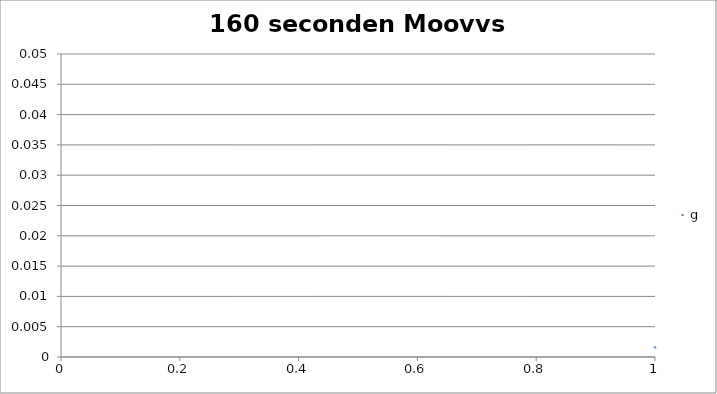
| Category | g |
|---|---|
| 0 | 0.002 |
| 1 | 0.005 |
| 2 | 0.004 |
| 3 | 0.005 |
| 4 | 0.006 |
| 5 | 0.005 |
| 6 | 0.003 |
| 7 | 0.004 |
| 8 | 0.007 |
| 9 | 0.009 |
| 10 | 0.005 |
| 11 | 0.002 |
| 12 | 0.005 |
| 13 | 0.003 |
| 14 | 0.009 |
| 15 | 0.007 |
| 16 | 0.002 |
| 17 | 0.007 |
| 18 | 0.002 |
| 19 | 0.003 |
| 20 | 0.005 |
| 21 | 0.005 |
| 22 | 0.006 |
| 23 | 0.006 |
| 24 | 0.007 |
| 25 | 0.009 |
| 26 | 0.004 |
| 27 | 0.006 |
| 28 | 0.006 |
| 29 | 0.004 |
| 30 | 0.005 |
| 31 | 0.002 |
| 32 | 0.007 |
| 33 | 0.004 |
| 34 | 0.003 |
| 35 | 0.013 |
| 36 | 0.016 |
| 37 | 0.005 |
| 38 | 0.004 |
| 39 | 0.004 |
| 40 | 0.007 |
| 41 | 0.007 |
| 42 | 0.005 |
| 43 | 0.004 |
| 44 | 0.002 |
| 45 | 0.003 |
| 46 | 0.008 |
| 47 | 0.003 |
| 48 | 0.002 |
| 49 | 0.003 |
| 50 | 0.002 |
| 51 | 0.004 |
| 52 | 0.002 |
| 53 | 0.002 |
| 54 | 0.004 |
| 55 | 0.004 |
| 56 | 0.001 |
| 57 | 0.002 |
| 58 | 0.003 |
| 59 | 0.003 |
| 60 | 0.001 |
| 61 | 0.005 |
| 62 | 0.007 |
| 63 | 0.004 |
| 64 | 0.002 |
| 65 | 0.006 |
| 66 | 0.007 |
| 67 | 0.004 |
| 68 | 0.003 |
| 69 | 0.002 |
| 70 | 0.007 |
| 71 | 0.006 |
| 72 | 0.004 |
| 73 | 0.006 |
| 74 | 0.002 |
| 75 | 0.004 |
| 76 | 0.001 |
| 77 | 0.007 |
| 78 | 0.009 |
| 79 | 0.004 |
| 80 | 0.006 |
| 81 | 0.004 |
| 82 | 0.006 |
| 83 | 0.007 |
| 84 | 0.001 |
| 85 | 0.003 |
| 86 | 0.005 |
| 87 | 0.009 |
| 88 | 0.001 |
| 89 | 0.002 |
| 90 | 0.003 |
| 91 | 0.005 |
| 92 | 0.002 |
| 93 | 0.002 |
| 94 | 0.001 |
| 95 | 0.006 |
| 96 | 0.002 |
| 97 | 0.002 |
| 98 | 0.003 |
| 99 | 0.008 |
| 100 | 0.002 |
| 101 | 0.001 |
| 102 | 0.003 |
| 103 | 0.005 |
| 104 | 0.001 |
| 105 | 0.002 |
| 106 | 0.004 |
| 107 | 0.003 |
| 108 | 0.001 |
| 109 | 0.003 |
| 110 | 0.002 |
| 111 | 0.004 |
| 112 | 0.003 |
| 113 | 0.004 |
| 114 | 0.004 |
| 115 | 0.002 |
| 116 | 0.004 |
| 117 | 0.007 |
| 118 | 0.012 |
| 119 | 0.003 |
| 120 | 0.001 |
| 121 | 0.004 |
| 122 | 0.003 |
| 123 | 0.002 |
| 124 | 0.003 |
| 125 | 0.002 |
| 126 | 0.004 |
| 127 | 0.004 |
| 128 | 0.003 |
| 129 | 0.003 |
| 130 | 0.004 |
| 131 | 0.007 |
| 132 | 0.002 |
| 133 | 0.003 |
| 134 | 0.002 |
| 135 | 0.001 |
| 136 | 0.008 |
| 137 | 0.003 |
| 138 | 0.005 |
| 139 | 0.007 |
| 140 | 0.001 |
| 141 | 0.001 |
| 142 | 0.001 |
| 143 | 0.005 |
| 144 | 0.002 |
| 145 | 0.007 |
| 146 | 0.006 |
| 147 | 0.005 |
| 148 | 0.002 |
| 149 | 0.003 |
| 150 | 0.007 |
| 151 | 0.003 |
| 152 | 0.005 |
| 153 | 0.003 |
| 154 | 0.002 |
| 155 | 0.002 |
| 156 | 0.004 |
| 157 | 0.003 |
| 158 | 0.006 |
| 159 | 0.004 |
| 160 | 0.005 |
| 161 | 0.002 |
| 162 | 0.003 |
| 163 | 0.004 |
| 164 | 0.002 |
| 165 | 0.006 |
| 166 | 0.005 |
| 167 | 0.005 |
| 168 | 0.005 |
| 169 | 0.002 |
| 170 | 0.008 |
| 171 | 0.002 |
| 172 | 0 |
| 173 | 0.009 |
| 174 | 0.009 |
| 175 | 0.006 |
| 176 | 0.002 |
| 177 | 0.002 |
| 178 | 0.004 |
| 179 | 0.005 |
| 180 | 0.003 |
| 181 | 0.003 |
| 182 | 0.004 |
| 183 | 0.007 |
| 184 | 0.003 |
| 185 | 0.003 |
| 186 | 0.002 |
| 187 | 0.004 |
| 188 | 0.003 |
| 189 | 0.003 |
| 190 | 0.005 |
| 191 | 0.002 |
| 192 | 0.003 |
| 193 | 0.003 |
| 194 | 0.01 |
| 195 | 0.001 |
| 196 | 0.008 |
| 197 | 0.002 |
| 198 | 0.004 |
| 199 | 0.005 |
| 200 | 0.005 |
| 201 | 0.006 |
| 202 | 0.006 |
| 203 | 0.007 |
| 204 | 0.002 |
| 205 | 0.002 |
| 206 | 0.004 |
| 207 | 0.008 |
| 208 | 0.013 |
| 209 | 0.002 |
| 210 | 0.004 |
| 211 | 0.002 |
| 212 | 0.002 |
| 213 | 0.003 |
| 214 | 0.004 |
| 215 | 0.006 |
| 216 | 0.004 |
| 217 | 0.002 |
| 218 | 0.003 |
| 219 | 0.009 |
| 220 | 0.002 |
| 221 | 0.002 |
| 222 | 0.009 |
| 223 | 0.005 |
| 224 | 0.005 |
| 225 | 0.007 |
| 226 | 0.005 |
| 227 | 0.004 |
| 228 | 0.001 |
| 229 | 0.001 |
| 230 | 0.008 |
| 231 | 0.003 |
| 232 | 0.001 |
| 233 | 0.004 |
| 234 | 0.006 |
| 235 | 0.007 |
| 236 | 0.003 |
| 237 | 0.002 |
| 238 | 0.005 |
| 239 | 0.004 |
| 240 | 0.002 |
| 241 | 0.002 |
| 242 | 0.005 |
| 243 | 0.004 |
| 244 | 0.001 |
| 245 | 0.002 |
| 246 | 0.004 |
| 247 | 0.006 |
| 248 | 0.003 |
| 249 | 0.002 |
| 250 | 0.003 |
| 251 | 0.002 |
| 252 | 0.005 |
| 253 | 0.006 |
| 254 | 0.005 |
| 255 | 0.004 |
| 256 | 0.004 |
| 257 | 0.003 |
| 258 | 0.006 |
| 259 | 0.003 |
| 260 | 0.006 |
| 261 | 0.002 |
| 262 | 0.002 |
| 263 | 0.006 |
| 264 | 0.011 |
| 265 | 0.003 |
| 266 | 0.002 |
| 267 | 0.004 |
| 268 | 0.005 |
| 269 | 0.001 |
| 270 | 0.003 |
| 271 | 0.002 |
| 272 | 0.003 |
| 273 | 0.002 |
| 274 | 0.005 |
| 275 | 0.001 |
| 276 | 0.003 |
| 277 | 0.004 |
| 278 | 0.005 |
| 279 | 0.002 |
| 280 | 0.005 |
| 281 | 0.002 |
| 282 | 0.004 |
| 283 | 0.003 |
| 284 | 0.009 |
| 285 | 0.003 |
| 286 | 0.003 |
| 287 | 0.002 |
| 288 | 0.001 |
| 289 | 0.002 |
| 290 | 0.005 |
| 291 | 0.002 |
| 292 | 0.003 |
| 293 | 0.002 |
| 294 | 0.001 |
| 295 | 0.006 |
| 296 | 0.001 |
| 297 | 0.009 |
| 298 | 0.001 |
| 299 | 0.005 |
| 300 | 0.003 |
| 301 | 0.002 |
| 302 | 0.004 |
| 303 | 0.003 |
| 304 | 0.002 |
| 305 | 0.004 |
| 306 | 0.006 |
| 307 | 0.007 |
| 308 | 0.002 |
| 309 | 0.002 |
| 310 | 0.011 |
| 311 | 0.01 |
| 312 | 0.002 |
| 313 | 0.005 |
| 314 | 0.004 |
| 315 | 0.008 |
| 316 | 0.008 |
| 317 | 0.002 |
| 318 | 0.002 |
| 319 | 0.006 |
| 320 | 0.004 |
| 321 | 0.003 |
| 322 | 0.003 |
| 323 | 0.004 |
| 324 | 0.004 |
| 325 | 0.002 |
| 326 | 0.003 |
| 327 | 0.004 |
| 328 | 0.004 |
| 329 | 0.006 |
| 330 | 0.004 |
| 331 | 0.002 |
| 332 | 0.005 |
| 333 | 0.007 |
| 334 | 0.008 |
| 335 | 0.008 |
| 336 | 0.008 |
| 337 | 0.007 |
| 338 | 0.004 |
| 339 | 0.008 |
| 340 | 0.005 |
| 341 | 0.005 |
| 342 | 0.008 |
| 343 | 0.008 |
| 344 | 0.01 |
| 345 | 0.007 |
| 346 | 0.007 |
| 347 | 0.007 |
| 348 | 0.004 |
| 349 | 0.006 |
| 350 | 0.004 |
| 351 | 0.005 |
| 352 | 0.007 |
| 353 | 0.002 |
| 354 | 0.004 |
| 355 | 0.003 |
| 356 | 0.003 |
| 357 | 0.007 |
| 358 | 0.004 |
| 359 | 0.004 |
| 360 | 0.002 |
| 361 | 0.003 |
| 362 | 0.006 |
| 363 | 0.007 |
| 364 | 0.003 |
| 365 | 0.004 |
| 366 | 0.003 |
| 367 | 0.007 |
| 368 | 0.002 |
| 369 | 0.007 |
| 370 | 0.004 |
| 371 | 0.003 |
| 372 | 0.004 |
| 373 | 0.006 |
| 374 | 0.006 |
| 375 | 0.004 |
| 376 | 0.005 |
| 377 | 0.004 |
| 378 | 0.005 |
| 379 | 0.003 |
| 380 | 0.004 |
| 381 | 0.002 |
| 382 | 0.007 |
| 383 | 0.006 |
| 384 | 0.004 |
| 385 | 0.004 |
| 386 | 0.005 |
| 387 | 0.006 |
| 388 | 0.003 |
| 389 | 0.002 |
| 390 | 0.002 |
| 391 | 0.004 |
| 392 | 0.003 |
| 393 | 0.006 |
| 394 | 0.01 |
| 395 | 0.007 |
| 396 | 0.003 |
| 397 | 0.004 |
| 398 | 0.004 |
| 399 | 0.007 |
| 400 | 0.001 |
| 401 | 0.004 |
| 402 | 0.004 |
| 403 | 0.003 |
| 404 | 0.001 |
| 405 | 0.003 |
| 406 | 0.006 |
| 407 | 0.002 |
| 408 | 0.003 |
| 409 | 0.001 |
| 410 | 0.003 |
| 411 | 0.004 |
| 412 | 0.001 |
| 413 | 0.001 |
| 414 | 0.005 |
| 415 | 0.005 |
| 416 | 0.003 |
| 417 | 0.002 |
| 418 | 0.004 |
| 419 | 0.002 |
| 420 | 0.001 |
| 421 | 0.001 |
| 422 | 0.002 |
| 423 | 0.004 |
| 424 | 0.003 |
| 425 | 0.002 |
| 426 | 0.005 |
| 427 | 0.006 |
| 428 | 0.002 |
| 429 | 0.004 |
| 430 | 0.008 |
| 431 | 0.003 |
| 432 | 0.002 |
| 433 | 0.002 |
| 434 | 0.007 |
| 435 | 0.003 |
| 436 | 0.003 |
| 437 | 0.002 |
| 438 | 0.005 |
| 439 | 0.006 |
| 440 | 0.004 |
| 441 | 0.001 |
| 442 | 0.004 |
| 443 | 0.012 |
| 444 | 0.005 |
| 445 | 0.007 |
| 446 | 0.011 |
| 447 | 0.009 |
| 448 | 0.003 |
| 449 | 0.003 |
| 450 | 0.01 |
| 451 | 0.004 |
| 452 | 0.004 |
| 453 | 0.003 |
| 454 | 0.003 |
| 455 | 0.005 |
| 456 | 0.002 |
| 457 | 0.003 |
| 458 | 0.005 |
| 459 | 0.001 |
| 460 | 0.003 |
| 461 | 0.003 |
| 462 | 0.009 |
| 463 | 0.011 |
| 464 | 0.003 |
| 465 | 0.003 |
| 466 | 0.005 |
| 467 | 0.002 |
| 468 | 0.003 |
| 469 | 0.006 |
| 470 | 0.003 |
| 471 | 0.009 |
| 472 | 0.002 |
| 473 | 0.002 |
| 474 | 0.004 |
| 475 | 0.001 |
| 476 | 0.003 |
| 477 | 0.003 |
| 478 | 0.006 |
| 479 | 0.009 |
| 480 | 0.003 |
| 481 | 0.004 |
| 482 | 0.003 |
| 483 | 0.004 |
| 484 | 0.001 |
| 485 | 0.003 |
| 486 | 0.007 |
| 487 | 0.009 |
| 488 | 0.003 |
| 489 | 0.004 |
| 490 | 0.004 |
| 491 | 0.003 |
| 492 | 0.001 |
| 493 | 0.003 |
| 494 | 0.005 |
| 495 | 0.003 |
| 496 | 0.002 |
| 497 | 0.002 |
| 498 | 0.005 |
| 499 | 0.01 |
| 500 | 0.002 |
| 501 | 0.004 |
| 502 | 0.003 |
| 503 | 0.004 |
| 504 | 0.003 |
| 505 | 0.001 |
| 506 | 0.008 |
| 507 | 0.014 |
| 508 | 0.002 |
| 509 | 0.005 |
| 510 | 0.003 |
| 511 | 0.006 |
| 512 | 0.004 |
| 513 | 0.003 |
| 514 | 0.008 |
| 515 | 0.008 |
| 516 | 0.001 |
| 517 | 0.002 |
| 518 | 0.003 |
| 519 | 0.008 |
| 520 | 0.003 |
| 521 | 0.002 |
| 522 | 0.006 |
| 523 | 0.008 |
| 524 | 0.002 |
| 525 | 0.001 |
| 526 | 0.004 |
| 527 | 0.004 |
| 528 | 0.005 |
| 529 | 0.002 |
| 530 | 0.009 |
| 531 | 0.006 |
| 532 | 0.004 |
| 533 | 0.005 |
| 534 | 0.004 |
| 535 | 0.005 |
| 536 | 0.007 |
| 537 | 0.008 |
| 538 | 0.007 |
| 539 | 0.005 |
| 540 | 0.003 |
| 541 | 0.005 |
| 542 | 0.002 |
| 543 | 0.005 |
| 544 | 0.006 |
| 545 | 0.001 |
| 546 | 0.003 |
| 547 | 0.004 |
| 548 | 0.007 |
| 549 | 0.002 |
| 550 | 0.001 |
| 551 | 0.004 |
| 552 | 0.004 |
| 553 | 0.002 |
| 554 | 0.003 |
| 555 | 0.003 |
| 556 | 0.005 |
| 557 | 0.006 |
| 558 | 0.003 |
| 559 | 0.004 |
| 560 | 0.006 |
| 561 | 0.002 |
| 562 | 0.008 |
| 563 | 0.001 |
| 564 | 0.006 |
| 565 | 0.009 |
| 566 | 0.003 |
| 567 | 0.004 |
| 568 | 0.003 |
| 569 | 0.005 |
| 570 | 0.007 |
| 571 | 0.006 |
| 572 | 0.003 |
| 573 | 0.003 |
| 574 | 0.004 |
| 575 | 0.004 |
| 576 | 0.008 |
| 577 | 0.004 |
| 578 | 0.004 |
| 579 | 0.002 |
| 580 | 0.002 |
| 581 | 0.002 |
| 582 | 0.002 |
| 583 | 0.01 |
| 584 | 0.002 |
| 585 | 0.002 |
| 586 | 0.003 |
| 587 | 0.008 |
| 588 | 0.004 |
| 589 | 0.012 |
| 590 | 0.008 |
| 591 | 0.004 |
| 592 | 0.002 |
| 593 | 0.002 |
| 594 | 0.004 |
| 595 | 0.002 |
| 596 | 0.005 |
| 597 | 0.002 |
| 598 | 0.003 |
| 599 | 0.004 |
| 600 | 0.003 |
| 601 | 0.006 |
| 602 | 0.002 |
| 603 | 0.003 |
| 604 | 0.002 |
| 605 | 0.004 |
| 606 | 0.005 |
| 607 | 0.003 |
| 608 | 0.007 |
| 609 | 0.004 |
| 610 | 0.003 |
| 611 | 0.006 |
| 612 | 0.004 |
| 613 | 0.003 |
| 614 | 0.002 |
| 615 | 0.006 |
| 616 | 0.006 |
| 617 | 0.005 |
| 618 | 0.007 |
| 619 | 0.007 |
| 620 | 0.007 |
| 621 | 0.004 |
| 622 | 0.004 |
| 623 | 0.001 |
| 624 | 0.001 |
| 625 | 0.006 |
| 626 | 0.003 |
| 627 | 0.011 |
| 628 | 0.004 |
| 629 | 0.004 |
| 630 | 0.005 |
| 631 | 0.003 |
| 632 | 0.008 |
| 633 | 0.006 |
| 634 | 0.007 |
| 635 | 0.003 |
| 636 | 0.008 |
| 637 | 0.004 |
| 638 | 0.004 |
| 639 | 0.013 |
| 640 | 0.007 |
| 641 | 0.006 |
| 642 | 0.006 |
| 643 | 0.008 |
| 644 | 0.007 |
| 645 | 0.006 |
| 646 | 0.006 |
| 647 | 0.002 |
| 648 | 0.001 |
| 649 | 0.002 |
| 650 | 0.004 |
| 651 | 0.003 |
| 652 | 0.003 |
| 653 | 0.003 |
| 654 | 0.003 |
| 655 | 0.003 |
| 656 | 0.005 |
| 657 | 0.003 |
| 658 | 0.001 |
| 659 | 0.007 |
| 660 | 0.001 |
| 661 | 0.004 |
| 662 | 0.006 |
| 663 | 0.006 |
| 664 | 0.003 |
| 665 | 0.002 |
| 666 | 0.003 |
| 667 | 0.007 |
| 668 | 0.003 |
| 669 | 0.004 |
| 670 | 0.002 |
| 671 | 0.001 |
| 672 | 0.003 |
| 673 | 0.002 |
| 674 | 0.003 |
| 675 | 0.004 |
| 676 | 0.004 |
| 677 | 0.002 |
| 678 | 0.002 |
| 679 | 0.004 |
| 680 | 0.009 |
| 681 | 0.002 |
| 682 | 0.003 |
| 683 | 0.002 |
| 684 | 0.002 |
| 685 | 0.003 |
| 686 | 0.004 |
| 687 | 0.006 |
| 688 | 0.002 |
| 689 | 0.004 |
| 690 | 0.005 |
| 691 | 0.005 |
| 692 | 0.003 |
| 693 | 0.003 |
| 694 | 0.004 |
| 695 | 0.004 |
| 696 | 0.002 |
| 697 | 0.002 |
| 698 | 0.004 |
| 699 | 0.003 |
| 700 | 0.002 |
| 701 | 0.001 |
| 702 | 0.003 |
| 703 | 0.005 |
| 704 | 0.003 |
| 705 | 0.005 |
| 706 | 0.01 |
| 707 | 0.004 |
| 708 | 0.003 |
| 709 | 0.006 |
| 710 | 0.005 |
| 711 | 0.008 |
| 712 | 0.003 |
| 713 | 0.002 |
| 714 | 0.004 |
| 715 | 0.005 |
| 716 | 0.003 |
| 717 | 0.002 |
| 718 | 0.004 |
| 719 | 0.002 |
| 720 | 0.005 |
| 721 | 0.004 |
| 722 | 0.006 |
| 723 | 0.003 |
| 724 | 0.002 |
| 725 | 0.003 |
| 726 | 0.004 |
| 727 | 0.006 |
| 728 | 0.002 |
| 729 | 0.004 |
| 730 | 0.005 |
| 731 | 0.005 |
| 732 | 0.001 |
| 733 | 0.006 |
| 734 | 0.005 |
| 735 | 0.006 |
| 736 | 0.001 |
| 737 | 0.006 |
| 738 | 0.004 |
| 739 | 0.006 |
| 740 | 0.005 |
| 741 | 0.002 |
| 742 | 0.003 |
| 743 | 0.007 |
| 744 | 0.002 |
| 745 | 0.006 |
| 746 | 0.003 |
| 747 | 0.005 |
| 748 | 0.001 |
| 749 | 0.004 |
| 750 | 0.014 |
| 751 | 0.006 |
| 752 | 0.001 |
| 753 | 0.002 |
| 754 | 0.003 |
| 755 | 0.004 |
| 756 | 0.002 |
| 757 | 0.001 |
| 758 | 0.003 |
| 759 | 0.007 |
| 760 | 0.002 |
| 761 | 0.002 |
| 762 | 0.003 |
| 763 | 0.012 |
| 764 | 0.003 |
| 765 | 0.004 |
| 766 | 0.013 |
| 767 | 0.015 |
| 768 | 0.008 |
| 769 | 0.001 |
| 770 | 0.004 |
| 771 | 0.002 |
| 772 | 0.002 |
| 773 | 0.002 |
| 774 | 0.003 |
| 775 | 0.007 |
| 776 | 0.009 |
| 777 | 0.003 |
| 778 | 0.004 |
| 779 | 0.002 |
| 780 | 0.004 |
| 781 | 0.003 |
| 782 | 0.004 |
| 783 | 0.005 |
| 784 | 0.003 |
| 785 | 0.001 |
| 786 | 0.004 |
| 787 | 0.004 |
| 788 | 0.005 |
| 789 | 0.004 |
| 790 | 0.002 |
| 791 | 0.002 |
| 792 | 0.003 |
| 793 | 0.002 |
| 794 | 0.004 |
| 795 | 0.007 |
| 796 | 0.011 |
| 797 | 0.002 |
| 798 | 0.003 |
| 799 | 0.004 |
| 800 | 0.006 |
| 801 | 0.002 |
| 802 | 0.007 |
| 803 | 0.009 |
| 804 | 0.006 |
| 805 | 0.004 |
| 806 | 0.004 |
| 807 | 0.004 |
| 808 | 0.004 |
| 809 | 0.006 |
| 810 | 0.004 |
| 811 | 0.004 |
| 812 | 0.001 |
| 813 | 0.003 |
| 814 | 0.001 |
| 815 | 0.005 |
| 816 | 0.016 |
| 817 | 0.001 |
| 818 | 0.002 |
| 819 | 0.009 |
| 820 | 0.004 |
| 821 | 0.005 |
| 822 | 0.006 |
| 823 | 0.006 |
| 824 | 0.012 |
| 825 | 0.007 |
| 826 | 0.006 |
| 827 | 0.01 |
| 828 | 0.003 |
| 829 | 0.003 |
| 830 | 0.008 |
| 831 | 0.008 |
| 832 | 0.002 |
| 833 | 0.003 |
| 834 | 0.004 |
| 835 | 0.002 |
| 836 | 0.001 |
| 837 | 0.001 |
| 838 | 0.005 |
| 839 | 0.005 |
| 840 | 0.006 |
| 841 | 0.005 |
| 842 | 0.006 |
| 843 | 0.004 |
| 844 | 0.001 |
| 845 | 0.003 |
| 846 | 0.002 |
| 847 | 0.009 |
| 848 | 0.002 |
| 849 | 0.003 |
| 850 | 0.01 |
| 851 | 0.003 |
| 852 | 0.003 |
| 853 | 0.005 |
| 854 | 0.005 |
| 855 | 0.005 |
| 856 | 0.002 |
| 857 | 0.004 |
| 858 | 0.005 |
| 859 | 0.006 |
| 860 | 0.002 |
| 861 | 0.003 |
| 862 | 0.009 |
| 863 | 0.004 |
| 864 | 0.002 |
| 865 | 0.002 |
| 866 | 0.003 |
| 867 | 0.008 |
| 868 | 0.003 |
| 869 | 0.001 |
| 870 | 0.002 |
| 871 | 0.003 |
| 872 | 0.007 |
| 873 | 0.004 |
| 874 | 0.002 |
| 875 | 0.003 |
| 876 | 0.006 |
| 877 | 0.004 |
| 878 | 0.004 |
| 879 | 0.006 |
| 880 | 0.007 |
| 881 | 0.002 |
| 882 | 0.004 |
| 883 | 0.003 |
| 884 | 0.007 |
| 885 | 0.002 |
| 886 | 0.002 |
| 887 | 0.001 |
| 888 | 0.005 |
| 889 | 0.009 |
| 890 | 0.006 |
| 891 | 0.007 |
| 892 | 0.005 |
| 893 | 0.004 |
| 894 | 0.004 |
| 895 | 0.005 |
| 896 | 0.003 |
| 897 | 0.001 |
| 898 | 0.003 |
| 899 | 0.005 |
| 900 | 0.001 |
| 901 | 0.003 |
| 902 | 0.003 |
| 903 | 0.002 |
| 904 | 0.007 |
| 905 | 0.002 |
| 906 | 0.002 |
| 907 | 0.002 |
| 908 | 0.003 |
| 909 | 0.001 |
| 910 | 0.006 |
| 911 | 0.005 |
| 912 | 0.002 |
| 913 | 0.002 |
| 914 | 0.003 |
| 915 | 0.002 |
| 916 | 0.002 |
| 917 | 0.01 |
| 918 | 0.007 |
| 919 | 0.004 |
| 920 | 0.008 |
| 921 | 0.004 |
| 922 | 0.01 |
| 923 | 0.007 |
| 924 | 0.007 |
| 925 | 0.003 |
| 926 | 0.003 |
| 927 | 0.001 |
| 928 | 0.003 |
| 929 | 0.003 |
| 930 | 0.001 |
| 931 | 0.005 |
| 932 | 0.002 |
| 933 | 0.004 |
| 934 | 0.004 |
| 935 | 0.005 |
| 936 | 0.006 |
| 937 | 0.004 |
| 938 | 0.01 |
| 939 | 0.005 |
| 940 | 0.003 |
| 941 | 0.003 |
| 942 | 0.005 |
| 943 | 0.004 |
| 944 | 0.01 |
| 945 | 0.006 |
| 946 | 0.001 |
| 947 | 0.003 |
| 948 | 0.005 |
| 949 | 0.005 |
| 950 | 0.002 |
| 951 | 0.007 |
| 952 | 0.004 |
| 953 | 0.008 |
| 954 | 0.007 |
| 955 | 0.004 |
| 956 | 0.013 |
| 957 | 0.006 |
| 958 | 0.004 |
| 959 | 0.002 |
| 960 | 0.003 |
| 961 | 0.004 |
| 962 | 0.007 |
| 963 | 0 |
| 964 | 0.005 |
| 965 | 0.003 |
| 966 | 0.002 |
| 967 | 0.005 |
| 968 | 0.011 |
| 969 | 0.007 |
| 970 | 0.005 |
| 971 | 0.003 |
| 972 | 0.008 |
| 973 | 0.002 |
| 974 | 0.006 |
| 975 | 0.01 |
| 976 | 0.002 |
| 977 | 0.002 |
| 978 | 0.003 |
| 979 | 0.004 |
| 980 | 0.004 |
| 981 | 0.001 |
| 982 | 0.003 |
| 983 | 0.002 |
| 984 | 0.002 |
| 985 | 0.002 |
| 986 | 0.002 |
| 987 | 0.006 |
| 988 | 0.005 |
| 989 | 0.004 |
| 990 | 0.003 |
| 991 | 0.006 |
| 992 | 0.004 |
| 993 | 0.006 |
| 994 | 0.008 |
| 995 | 0.005 |
| 996 | 0.003 |
| 997 | 0.003 |
| 998 | 0.005 |
| 999 | 0.005 |
| 1000 | 0.003 |
| 1001 | 0.004 |
| 1002 | 0.005 |
| 1003 | 0.005 |
| 1004 | 0.002 |
| 1005 | 0.001 |
| 1006 | 0.009 |
| 1007 | 0.006 |
| 1008 | 0.003 |
| 1009 | 0.005 |
| 1010 | 0.005 |
| 1011 | 0.005 |
| 1012 | 0.003 |
| 1013 | 0.008 |
| 1014 | 0.002 |
| 1015 | 0.004 |
| 1016 | 0.006 |
| 1017 | 0.002 |
| 1018 | 0.001 |
| 1019 | 0.007 |
| 1020 | 0.004 |
| 1021 | 0.003 |
| 1022 | 0.003 |
| 1023 | 0.008 |
| 1024 | 0.004 |
| 1025 | 0.002 |
| 1026 | 0.008 |
| 1027 | 0.006 |
| 1028 | 0.003 |
| 1029 | 0.002 |
| 1030 | 0.002 |
| 1031 | 0.003 |
| 1032 | 0.002 |
| 1033 | 0.002 |
| 1034 | 0.003 |
| 1035 | 0.009 |
| 1036 | 0.004 |
| 1037 | 0.008 |
| 1038 | 0.01 |
| 1039 | 0.007 |
| 1040 | 0.002 |
| 1041 | 0.003 |
| 1042 | 0.002 |
| 1043 | 0.005 |
| 1044 | 0.003 |
| 1045 | 0.002 |
| 1046 | 0.005 |
| 1047 | 0.003 |
| 1048 | 0.001 |
| 1049 | 0.002 |
| 1050 | 0.007 |
| 1051 | 0.006 |
| 1052 | 0.003 |
| 1053 | 0.003 |
| 1054 | 0.003 |
| 1055 | 0.006 |
| 1056 | 0.003 |
| 1057 | 0.002 |
| 1058 | 0.003 |
| 1059 | 0.01 |
| 1060 | 0.003 |
| 1061 | 0.004 |
| 1062 | 0.004 |
| 1063 | 0.004 |
| 1064 | 0.005 |
| 1065 | 0.002 |
| 1066 | 0.004 |
| 1067 | 0.006 |
| 1068 | 0.001 |
| 1069 | 0.001 |
| 1070 | 0.007 |
| 1071 | 0.005 |
| 1072 | 0.002 |
| 1073 | 0.002 |
| 1074 | 0.003 |
| 1075 | 0.003 |
| 1076 | 0.001 |
| 1077 | 0.003 |
| 1078 | 0.003 |
| 1079 | 0.004 |
| 1080 | 0.003 |
| 1081 | 0.003 |
| 1082 | 0.007 |
| 1083 | 0.009 |
| 1084 | 0.004 |
| 1085 | 0.006 |
| 1086 | 0.006 |
| 1087 | 0.006 |
| 1088 | 0.002 |
| 1089 | 0.007 |
| 1090 | 0.003 |
| 1091 | 0.007 |
| 1092 | 0.003 |
| 1093 | 0.003 |
| 1094 | 0.004 |
| 1095 | 0.003 |
| 1096 | 0.003 |
| 1097 | 0.002 |
| 1098 | 0.005 |
| 1099 | 0.003 |
| 1100 | 0.003 |
| 1101 | 0.002 |
| 1102 | 0.005 |
| 1103 | 0.006 |
| 1104 | 0.003 |
| 1105 | 0.003 |
| 1106 | 0.007 |
| 1107 | 0.004 |
| 1108 | 0.004 |
| 1109 | 0.002 |
| 1110 | 0.003 |
| 1111 | 0.009 |
| 1112 | 0.003 |
| 1113 | 0.004 |
| 1114 | 0.003 |
| 1115 | 0.005 |
| 1116 | 0.004 |
| 1117 | 0.007 |
| 1118 | 0.006 |
| 1119 | 0.007 |
| 1120 | 0.001 |
| 1121 | 0.003 |
| 1122 | 0.006 |
| 1123 | 0.005 |
| 1124 | 0.003 |
| 1125 | 0.004 |
| 1126 | 0.006 |
| 1127 | 0.003 |
| 1128 | 0.001 |
| 1129 | 0.002 |
| 1130 | 0.007 |
| 1131 | 0.002 |
| 1132 | 0.004 |
| 1133 | 0.004 |
| 1134 | 0.005 |
| 1135 | 0.002 |
| 1136 | 0.006 |
| 1137 | 0.009 |
| 1138 | 0.005 |
| 1139 | 0.002 |
| 1140 | 0.002 |
| 1141 | 0.004 |
| 1142 | 0.004 |
| 1143 | 0 |
| 1144 | 0.002 |
| 1145 | 0.003 |
| 1146 | 0.003 |
| 1147 | 0.003 |
| 1148 | 0.002 |
| 1149 | 0.002 |
| 1150 | 0.008 |
| 1151 | 0.004 |
| 1152 | 0.001 |
| 1153 | 0.002 |
| 1154 | 0.012 |
| 1155 | 0.004 |
| 1156 | 0.001 |
| 1157 | 0.004 |
| 1158 | 0.009 |
| 1159 | 0.012 |
| 1160 | 0.009 |
| 1161 | 0.002 |
| 1162 | 0.003 |
| 1163 | 0.001 |
| 1164 | 0.003 |
| 1165 | 0.003 |
| 1166 | 0.003 |
| 1167 | 0.003 |
| 1168 | 0.006 |
| 1169 | 0.002 |
| 1170 | 0.007 |
| 1171 | 0.002 |
| 1172 | 0.007 |
| 1173 | 0.001 |
| 1174 | 0.007 |
| 1175 | 0.009 |
| 1176 | 0.008 |
| 1177 | 0.005 |
| 1178 | 0.007 |
| 1179 | 0.001 |
| 1180 | 0.004 |
| 1181 | 0.005 |
| 1182 | 0.002 |
| 1183 | 0.002 |
| 1184 | 0.006 |
| 1185 | 0.003 |
| 1186 | 0.002 |
| 1187 | 0.004 |
| 1188 | 0.002 |
| 1189 | 0.002 |
| 1190 | 0.003 |
| 1191 | 0.009 |
| 1192 | 0.004 |
| 1193 | 0.007 |
| 1194 | 0.01 |
| 1195 | 0.005 |
| 1196 | 0.007 |
| 1197 | 0.007 |
| 1198 | 0.003 |
| 1199 | 0.002 |
| 1200 | 0.004 |
| 1201 | 0.011 |
| 1202 | 0.008 |
| 1203 | 0.004 |
| 1204 | 0.008 |
| 1205 | 0.004 |
| 1206 | 0.005 |
| 1207 | 0.007 |
| 1208 | 0.005 |
| 1209 | 0.007 |
| 1210 | 0.003 |
| 1211 | 0.006 |
| 1212 | 0.008 |
| 1213 | 0.003 |
| 1214 | 0.007 |
| 1215 | 0.005 |
| 1216 | 0.004 |
| 1217 | 0.002 |
| 1218 | 0.001 |
| 1219 | 0.003 |
| 1220 | 0.002 |
| 1221 | 0.006 |
| 1222 | 0.004 |
| 1223 | 0.001 |
| 1224 | 0.006 |
| 1225 | 0.001 |
| 1226 | 0.005 |
| 1227 | 0.002 |
| 1228 | 0.005 |
| 1229 | 0.005 |
| 1230 | 0.004 |
| 1231 | 0.003 |
| 1232 | 0.007 |
| 1233 | 0.01 |
| 1234 | 0.006 |
| 1235 | 0.003 |
| 1236 | 0.003 |
| 1237 | 0.003 |
| 1238 | 0.004 |
| 1239 | 0.004 |
| 1240 | 0.004 |
| 1241 | 0.005 |
| 1242 | 0.005 |
| 1243 | 0.006 |
| 1244 | 0.002 |
| 1245 | 0.001 |
| 1246 | 0.004 |
| 1247 | 0.009 |
| 1248 | 0.003 |
| 1249 | 0.007 |
| 1250 | 0.004 |
| 1251 | 0.002 |
| 1252 | 0.005 |
| 1253 | 0.009 |
| 1254 | 0.004 |
| 1255 | 0.001 |
| 1256 | 0.001 |
| 1257 | 0.004 |
| 1258 | 0.01 |
| 1259 | 0.005 |
| 1260 | 0.002 |
| 1261 | 0.005 |
| 1262 | 0.009 |
| 1263 | 0.008 |
| 1264 | 0.004 |
| 1265 | 0.003 |
| 1266 | 0.006 |
| 1267 | 0.003 |
| 1268 | 0.005 |
| 1269 | 0.004 |
| 1270 | 0.003 |
| 1271 | 0.004 |
| 1272 | 0.002 |
| 1273 | 0.005 |
| 1274 | 0.004 |
| 1275 | 0.005 |
| 1276 | 0.001 |
| 1277 | 0.007 |
| 1278 | 0.002 |
| 1279 | 0.002 |
| 1280 | 0.007 |
| 1281 | 0.008 |
| 1282 | 0.006 |
| 1283 | 0.007 |
| 1284 | 0.003 |
| 1285 | 0.001 |
| 1286 | 0.004 |
| 1287 | 0.008 |
| 1288 | 0.002 |
| 1289 | 0.004 |
| 1290 | 0.002 |
| 1291 | 0.007 |
| 1292 | 0.001 |
| 1293 | 0.002 |
| 1294 | 0.002 |
| 1295 | 0.004 |
| 1296 | 0.002 |
| 1297 | 0.002 |
| 1298 | 0.002 |
| 1299 | 0.002 |
| 1300 | 0.003 |
| 1301 | 0.002 |
| 1302 | 0.007 |
| 1303 | 0.004 |
| 1304 | 0.007 |
| 1305 | 0.006 |
| 1306 | 0.01 |
| 1307 | 0.004 |
| 1308 | 0.001 |
| 1309 | 0.002 |
| 1310 | 0.004 |
| 1311 | 0.005 |
| 1312 | 0.002 |
| 1313 | 0.002 |
| 1314 | 0.007 |
| 1315 | 0.003 |
| 1316 | 0.001 |
| 1317 | 0.001 |
| 1318 | 0.005 |
| 1319 | 0.004 |
| 1320 | 0.002 |
| 1321 | 0.004 |
| 1322 | 0.003 |
| 1323 | 0.003 |
| 1324 | 0.001 |
| 1325 | 0.003 |
| 1326 | 0.005 |
| 1327 | 0.003 |
| 1328 | 0.001 |
| 1329 | 0.001 |
| 1330 | 0.006 |
| 1331 | 0.005 |
| 1332 | 0.006 |
| 1333 | 0.003 |
| 1334 | 0.005 |
| 1335 | 0.002 |
| 1336 | 0.002 |
| 1337 | 0.004 |
| 1338 | 0.005 |
| 1339 | 0.002 |
| 1340 | 0.011 |
| 1341 | 0.003 |
| 1342 | 0.003 |
| 1343 | 0.007 |
| 1344 | 0.005 |
| 1345 | 0.003 |
| 1346 | 0.002 |
| 1347 | 0.006 |
| 1348 | 0.002 |
| 1349 | 0.005 |
| 1350 | 0.002 |
| 1351 | 0.002 |
| 1352 | 0.003 |
| 1353 | 0.003 |
| 1354 | 0.004 |
| 1355 | 0.005 |
| 1356 | 0.002 |
| 1357 | 0.006 |
| 1358 | 0.005 |
| 1359 | 0.007 |
| 1360 | 0.002 |
| 1361 | 0.006 |
| 1362 | 0.01 |
| 1363 | 0.005 |
| 1364 | 0.002 |
| 1365 | 0.002 |
| 1366 | 0.008 |
| 1367 | 0.009 |
| 1368 | 0.003 |
| 1369 | 0.005 |
| 1370 | 0.009 |
| 1371 | 0.002 |
| 1372 | 0.003 |
| 1373 | 0.003 |
| 1374 | 0.008 |
| 1375 | 0.005 |
| 1376 | 0.003 |
| 1377 | 0.003 |
| 1378 | 0.004 |
| 1379 | 0.007 |
| 1380 | 0.003 |
| 1381 | 0.002 |
| 1382 | 0.006 |
| 1383 | 0.001 |
| 1384 | 0.002 |
| 1385 | 0.003 |
| 1386 | 0.005 |
| 1387 | 0.006 |
| 1388 | 0.002 |
| 1389 | 0.006 |
| 1390 | 0.013 |
| 1391 | 0.005 |
| 1392 | 0.001 |
| 1393 | 0.002 |
| 1394 | 0.001 |
| 1395 | 0.003 |
| 1396 | 0.002 |
| 1397 | 0.008 |
| 1398 | 0.007 |
| 1399 | 0.006 |
| 1400 | 0.002 |
| 1401 | 0.003 |
| 1402 | 0.004 |
| 1403 | 0.009 |
| 1404 | 0.004 |
| 1405 | 0.006 |
| 1406 | 0.009 |
| 1407 | 0.005 |
| 1408 | 0.002 |
| 1409 | 0.003 |
| 1410 | 0.004 |
| 1411 | 0.003 |
| 1412 | 0.002 |
| 1413 | 0.007 |
| 1414 | 0.005 |
| 1415 | 0.006 |
| 1416 | 0.004 |
| 1417 | 0.006 |
| 1418 | 0.004 |
| 1419 | 0.002 |
| 1420 | 0.004 |
| 1421 | 0.004 |
| 1422 | 0.004 |
| 1423 | 0.004 |
| 1424 | 0.008 |
| 1425 | 0.003 |
| 1426 | 0.004 |
| 1427 | 0.005 |
| 1428 | 0.002 |
| 1429 | 0.002 |
| 1430 | 0.006 |
| 1431 | 0.005 |
| 1432 | 0.003 |
| 1433 | 0.007 |
| 1434 | 0.006 |
| 1435 | 0.004 |
| 1436 | 0.004 |
| 1437 | 0.006 |
| 1438 | 0.004 |
| 1439 | 0.006 |
| 1440 | 0.004 |
| 1441 | 0.004 |
| 1442 | 0.001 |
| 1443 | 0.005 |
| 1444 | 0.002 |
| 1445 | 0.002 |
| 1446 | 0.004 |
| 1447 | 0.005 |
| 1448 | 0.002 |
| 1449 | 0.003 |
| 1450 | 0.002 |
| 1451 | 0.004 |
| 1452 | 0.002 |
| 1453 | 0.002 |
| 1454 | 0.007 |
| 1455 | 0.007 |
| 1456 | 0.004 |
| 1457 | 0.002 |
| 1458 | 0.004 |
| 1459 | 0.008 |
| 1460 | 0.003 |
| 1461 | 0.006 |
| 1462 | 0.007 |
| 1463 | 0.005 |
| 1464 | 0.003 |
| 1465 | 0.001 |
| 1466 | 0.005 |
| 1467 | 0.002 |
| 1468 | 0.004 |
| 1469 | 0.004 |
| 1470 | 0.011 |
| 1471 | 0.006 |
| 1472 | 0.002 |
| 1473 | 0.003 |
| 1474 | 0.01 |
| 1475 | 0.009 |
| 1476 | 0.002 |
| 1477 | 0.004 |
| 1478 | 0.002 |
| 1479 | 0.003 |
| 1480 | 0.005 |
| 1481 | 0.002 |
| 1482 | 0.005 |
| 1483 | 0.003 |
| 1484 | 0.004 |
| 1485 | 0.001 |
| 1486 | 0.001 |
| 1487 | 0.004 |
| 1488 | 0.004 |
| 1489 | 0.003 |
| 1490 | 0.002 |
| 1491 | 0.007 |
| 1492 | 0.003 |
| 1493 | 0.003 |
| 1494 | 0.003 |
| 1495 | 0.005 |
| 1496 | 0.003 |
| 1497 | 0.003 |
| 1498 | 0.003 |
| 1499 | 0.004 |
| 1500 | 0.004 |
| 1501 | 0.001 |
| 1502 | 0.003 |
| 1503 | 0.002 |
| 1504 | 0.002 |
| 1505 | 0.005 |
| 1506 | 0.002 |
| 1507 | 0.004 |
| 1508 | 0.003 |
| 1509 | 0.004 |
| 1510 | 0.001 |
| 1511 | 0.001 |
| 1512 | 0.002 |
| 1513 | 0.002 |
| 1514 | 0.002 |
| 1515 | 0.001 |
| 1516 | 0.003 |
| 1517 | 0.001 |
| 1518 | 0.002 |
| 1519 | 0.008 |
| 1520 | 0.002 |
| 1521 | 0.001 |
| 1522 | 0.001 |
| 1523 | 0.003 |
| 1524 | 0.001 |
| 1525 | 0.003 |
| 1526 | 0.003 |
| 1527 | 0.002 |
| 1528 | 0.003 |
| 1529 | 0.006 |
| 1530 | 0.005 |
| 1531 | 0.009 |
| 1532 | 0.007 |
| 1533 | 0.005 |
| 1534 | 0.004 |
| 1535 | 0.003 |
| 1536 | 0.004 |
| 1537 | 0.003 |
| 1538 | 0.004 |
| 1539 | 0.007 |
| 1540 | 0.002 |
| 1541 | 0.006 |
| 1542 | 0.008 |
| 1543 | 0.01 |
| 1544 | 0.006 |
| 1545 | 0.005 |
| 1546 | 0.002 |
| 1547 | 0.003 |
| 1548 | 0.002 |
| 1549 | 0.004 |
| 1550 | 0.007 |
| 1551 | 0.009 |
| 1552 | 0.004 |
| 1553 | 0.005 |
| 1554 | 0.006 |
| 1555 | 0.007 |
| 1556 | 0.003 |
| 1557 | 0.001 |
| 1558 | 0.009 |
| 1559 | 0.009 |
| 1560 | 0.003 |
| 1561 | 0.004 |
| 1562 | 0 |
| 1563 | 0.004 |
| 1564 | 0.01 |
| 1565 | 0.007 |
| 1566 | 0.005 |
| 1567 | 0.006 |
| 1568 | 0.002 |
| 1569 | 0.007 |
| 1570 | 0.007 |
| 1571 | 0.002 |
| 1572 | 0.007 |
| 1573 | 0.005 |
| 1574 | 0.001 |
| 1575 | 0.003 |
| 1576 | 0.001 |
| 1577 | 0.005 |
| 1578 | 0.007 |
| 1579 | 0.007 |
| 1580 | 0.005 |
| 1581 | 0.005 |
| 1582 | 0.006 |
| 1583 | 0.003 |
| 1584 | 0.002 |
| 1585 | 0.007 |
| 1586 | 0.008 |
| 1587 | 0.003 |
| 1588 | 0.002 |
| 1589 | 0.002 |
| 1590 | 0.005 |
| 1591 | 0.008 |
| 1592 | 0.003 |
| 1593 | 0.001 |
| 1594 | 0.003 |
| 1595 | 0.005 |
| 1596 | 0.002 |
| 1597 | 0.002 |
| 1598 | 0.009 |
| 1599 | 0.003 |
| 1600 | 0.002 |
| 1601 | 0.004 |
| 1602 | 0.006 |
| 1603 | 0.002 |
| 1604 | 0.003 |
| 1605 | 0.006 |
| 1606 | 0.003 |
| 1607 | 0.005 |
| 1608 | 0.004 |
| 1609 | 0.002 |
| 1610 | 0.001 |
| 1611 | 0.004 |
| 1612 | 0.001 |
| 1613 | 0.001 |
| 1614 | 0.007 |
| 1615 | 0.004 |
| 1616 | 0.002 |
| 1617 | 0.001 |
| 1618 | 0.005 |
| 1619 | 0.005 |
| 1620 | 0.005 |
| 1621 | 0.006 |
| 1622 | 0.003 |
| 1623 | 0.004 |
| 1624 | 0.003 |
| 1625 | 0.003 |
| 1626 | 0.006 |
| 1627 | 0.008 |
| 1628 | 0.003 |
| 1629 | 0.003 |
| 1630 | 0.002 |
| 1631 | 0.003 |
| 1632 | 0.003 |
| 1633 | 0.008 |
| 1634 | 0.01 |
| 1635 | 0.009 |
| 1636 | 0.001 |
| 1637 | 0.003 |
| 1638 | 0.006 |
| 1639 | 0.003 |
| 1640 | 0.003 |
| 1641 | 0.003 |
| 1642 | 0.006 |
| 1643 | 0.006 |
| 1644 | 0.002 |
| 1645 | 0.003 |
| 1646 | 0.006 |
| 1647 | 0.007 |
| 1648 | 0.003 |
| 1649 | 0.005 |
| 1650 | 0.007 |
| 1651 | 0.006 |
| 1652 | 0.002 |
| 1653 | 0.002 |
| 1654 | 0.005 |
| 1655 | 0.01 |
| 1656 | 0.006 |
| 1657 | 0.004 |
| 1658 | 0.005 |
| 1659 | 0.005 |
| 1660 | 0.003 |
| 1661 | 0.001 |
| 1662 | 0.005 |
| 1663 | 0.008 |
| 1664 | 0.002 |
| 1665 | 0.001 |
| 1666 | 0.004 |
| 1667 | 0.004 |
| 1668 | 0.002 |
| 1669 | 0.003 |
| 1670 | 0.004 |
| 1671 | 0.008 |
| 1672 | 0.003 |
| 1673 | 0.002 |
| 1674 | 0.002 |
| 1675 | 0.001 |
| 1676 | 0.002 |
| 1677 | 0.002 |
| 1678 | 0.005 |
| 1679 | 0.008 |
| 1680 | 0.004 |
| 1681 | 0.007 |
| 1682 | 0.005 |
| 1683 | 0.01 |
| 1684 | 0.001 |
| 1685 | 0.009 |
| 1686 | 0.002 |
| 1687 | 0.002 |
| 1688 | 0.003 |
| 1689 | 0.003 |
| 1690 | 0.012 |
| 1691 | 0.009 |
| 1692 | 0.001 |
| 1693 | 0.002 |
| 1694 | 0.003 |
| 1695 | 0.005 |
| 1696 | 0.002 |
| 1697 | 0.005 |
| 1698 | 0.002 |
| 1699 | 0.009 |
| 1700 | 0.004 |
| 1701 | 0.004 |
| 1702 | 0.006 |
| 1703 | 0.007 |
| 1704 | 0.005 |
| 1705 | 0.004 |
| 1706 | 0.002 |
| 1707 | 0.005 |
| 1708 | 0.005 |
| 1709 | 0.004 |
| 1710 | 0.002 |
| 1711 | 0.003 |
| 1712 | 0.001 |
| 1713 | 0.002 |
| 1714 | 0.004 |
| 1715 | 0.006 |
| 1716 | 0.004 |
| 1717 | 0.004 |
| 1718 | 0.001 |
| 1719 | 0.002 |
| 1720 | 0.004 |
| 1721 | 0.002 |
| 1722 | 0.006 |
| 1723 | 0.008 |
| 1724 | 0.01 |
| 1725 | 0.002 |
| 1726 | 0.003 |
| 1727 | 0.002 |
| 1728 | 0.005 |
| 1729 | 0.002 |
| 1730 | 0.002 |
| 1731 | 0.004 |
| 1732 | 0.003 |
| 1733 | 0.004 |
| 1734 | 0.002 |
| 1735 | 0.007 |
| 1736 | 0.005 |
| 1737 | 0.006 |
| 1738 | 0.01 |
| 1739 | 0.004 |
| 1740 | 0.005 |
| 1741 | 0.001 |
| 1742 | 0.003 |
| 1743 | 0.004 |
| 1744 | 0.002 |
| 1745 | 0.003 |
| 1746 | 0.004 |
| 1747 | 0.005 |
| 1748 | 0.004 |
| 1749 | 0.006 |
| 1750 | 0.003 |
| 1751 | 0.005 |
| 1752 | 0.003 |
| 1753 | 0.004 |
| 1754 | 0.005 |
| 1755 | 0.004 |
| 1756 | 0.003 |
| 1757 | 0.003 |
| 1758 | 0.006 |
| 1759 | 0.008 |
| 1760 | 0.003 |
| 1761 | 0.003 |
| 1762 | 0.004 |
| 1763 | 0.003 |
| 1764 | 0.002 |
| 1765 | 0.004 |
| 1766 | 0.009 |
| 1767 | 0.004 |
| 1768 | 0.003 |
| 1769 | 0.003 |
| 1770 | 0.003 |
| 1771 | 0.001 |
| 1772 | 0.004 |
| 1773 | 0.002 |
| 1774 | 0.007 |
| 1775 | 0.004 |
| 1776 | 0.003 |
| 1777 | 0.003 |
| 1778 | 0.003 |
| 1779 | 0.007 |
| 1780 | 0.009 |
| 1781 | 0.003 |
| 1782 | 0.003 |
| 1783 | 0.006 |
| 1784 | 0.006 |
| 1785 | 0.003 |
| 1786 | 0.005 |
| 1787 | 0.005 |
| 1788 | 0.001 |
| 1789 | 0.001 |
| 1790 | 0.001 |
| 1791 | 0.003 |
| 1792 | 0.008 |
| 1793 | 0.002 |
| 1794 | 0.003 |
| 1795 | 0.003 |
| 1796 | 0.003 |
| 1797 | 0.004 |
| 1798 | 0.002 |
| 1799 | 0.002 |
| 1800 | 0.006 |
| 1801 | 0.001 |
| 1802 | 0.002 |
| 1803 | 0.002 |
| 1804 | 0.003 |
| 1805 | 0.003 |
| 1806 | 0.008 |
| 1807 | 0.003 |
| 1808 | 0.002 |
| 1809 | 0.004 |
| 1810 | 0.004 |
| 1811 | 0.003 |
| 1812 | 0.002 |
| 1813 | 0.009 |
| 1814 | 0 |
| 1815 | 0.001 |
| 1816 | 0.002 |
| 1817 | 0.006 |
| 1818 | 0.007 |
| 1819 | 0.005 |
| 1820 | 0.003 |
| 1821 | 0.002 |
| 1822 | 0.004 |
| 1823 | 0.007 |
| 1824 | 0.002 |
| 1825 | 0.004 |
| 1826 | 0.004 |
| 1827 | 0.003 |
| 1828 | 0.004 |
| 1829 | 0.005 |
| 1830 | 0.003 |
| 1831 | 0.002 |
| 1832 | 0.003 |
| 1833 | 0.008 |
| 1834 | 0.008 |
| 1835 | 0.004 |
| 1836 | 0.003 |
| 1837 | 0.004 |
| 1838 | 0.003 |
| 1839 | 0.006 |
| 1840 | 0.006 |
| 1841 | 0.009 |
| 1842 | 0.002 |
| 1843 | 0.008 |
| 1844 | 0.005 |
| 1845 | 0.005 |
| 1846 | 0.005 |
| 1847 | 0.003 |
| 1848 | 0.016 |
| 1849 | 0.007 |
| 1850 | 0.004 |
| 1851 | 0.003 |
| 1852 | 0.006 |
| 1853 | 0.006 |
| 1854 | 0.01 |
| 1855 | 0.008 |
| 1856 | 0.007 |
| 1857 | 0.002 |
| 1858 | 0.005 |
| 1859 | 0.003 |
| 1860 | 0.009 |
| 1861 | 0.007 |
| 1862 | 0.004 |
| 1863 | 0.008 |
| 1864 | 0.005 |
| 1865 | 0.005 |
| 1866 | 0.001 |
| 1867 | 0.005 |
| 1868 | 0.005 |
| 1869 | 0.004 |
| 1870 | 0.003 |
| 1871 | 0.004 |
| 1872 | 0.003 |
| 1873 | 0.007 |
| 1874 | 0.006 |
| 1875 | 0.004 |
| 1876 | 0.009 |
| 1877 | 0.002 |
| 1878 | 0.003 |
| 1879 | 0.006 |
| 1880 | 0.003 |
| 1881 | 0.007 |
| 1882 | 0.007 |
| 1883 | 0.006 |
| 1884 | 0.002 |
| 1885 | 0.001 |
| 1886 | 0.01 |
| 1887 | 0.006 |
| 1888 | 0.001 |
| 1889 | 0.002 |
| 1890 | 0.011 |
| 1891 | 0.007 |
| 1892 | 0.002 |
| 1893 | 0.003 |
| 1894 | 0.004 |
| 1895 | 0.002 |
| 1896 | 0.003 |
| 1897 | 0.004 |
| 1898 | 0.002 |
| 1899 | 0.008 |
| 1900 | 0.004 |
| 1901 | 0.003 |
| 1902 | 0.003 |
| 1903 | 0.004 |
| 1904 | 0.008 |
| 1905 | 0.004 |
| 1906 | 0.005 |
| 1907 | 0.002 |
| 1908 | 0.004 |
| 1909 | 0.005 |
| 1910 | 0.01 |
| 1911 | 0.006 |
| 1912 | 0.002 |
| 1913 | 0.003 |
| 1914 | 0.004 |
| 1915 | 0.006 |
| 1916 | 0.004 |
| 1917 | 0.005 |
| 1918 | 0.003 |
| 1919 | 0.008 |
| 1920 | 0.002 |
| 1921 | 0.002 |
| 1922 | 0.004 |
| 1923 | 0.008 |
| 1924 | 0.002 |
| 1925 | 0.004 |
| 1926 | 0.01 |
| 1927 | 0.005 |
| 1928 | 0.003 |
| 1929 | 0.006 |
| 1930 | 0.008 |
| 1931 | 0.005 |
| 1932 | 0.002 |
| 1933 | 0.007 |
| 1934 | 0.007 |
| 1935 | 0.01 |
| 1936 | 0.002 |
| 1937 | 0.004 |
| 1938 | 0.003 |
| 1939 | 0.004 |
| 1940 | 0.002 |
| 1941 | 0.004 |
| 1942 | 0.006 |
| 1943 | 0.005 |
| 1944 | 0.003 |
| 1945 | 0.002 |
| 1946 | 0.003 |
| 1947 | 0.015 |
| 1948 | 0.002 |
| 1949 | 0.003 |
| 1950 | 0.003 |
| 1951 | 0.003 |
| 1952 | 0.002 |
| 1953 | 0.004 |
| 1954 | 0.001 |
| 1955 | 0.007 |
| 1956 | 0.001 |
| 1957 | 0.004 |
| 1958 | 0.001 |
| 1959 | 0.002 |
| 1960 | 0.002 |
| 1961 | 0.003 |
| 1962 | 0.002 |
| 1963 | 0.011 |
| 1964 | 0.001 |
| 1965 | 0.002 |
| 1966 | 0.004 |
| 1967 | 0.005 |
| 1968 | 0.004 |
| 1969 | 0.006 |
| 1970 | 0.003 |
| 1971 | 0.004 |
| 1972 | 0.001 |
| 1973 | 0.002 |
| 1974 | 0.003 |
| 1975 | 0.013 |
| 1976 | 0.003 |
| 1977 | 0.003 |
| 1978 | 0.005 |
| 1979 | 0.004 |
| 1980 | 0.001 |
| 1981 | 0.003 |
| 1982 | 0.001 |
| 1983 | 0.005 |
| 1984 | 0.001 |
| 1985 | 0.008 |
| 1986 | 0.003 |
| 1987 | 0.003 |
| 1988 | 0.004 |
| 1989 | 0.003 |
| 1990 | 0.008 |
| 1991 | 0.004 |
| 1992 | 0.003 |
| 1993 | 0.002 |
| 1994 | 0.005 |
| 1995 | 0.004 |
| 1996 | 0.004 |
| 1997 | 0.003 |
| 1998 | 0.005 |
| 1999 | 0.002 |
| 2000 | 0.002 |
| 2001 | 0.004 |
| 2002 | 0.002 |
| 2003 | 0.005 |
| 2004 | 0.004 |
| 2005 | 0.007 |
| 2006 | 0.009 |
| 2007 | 0.004 |
| 2008 | 0.003 |
| 2009 | 0.003 |
| 2010 | 0.002 |
| 2011 | 0.002 |
| 2012 | 0.005 |
| 2013 | 0.002 |
| 2014 | 0.003 |
| 2015 | 0.008 |
| 2016 | 0.001 |
| 2017 | 0.005 |
| 2018 | 0.008 |
| 2019 | 0.008 |
| 2020 | 0.002 |
| 2021 | 0.002 |
| 2022 | 0.005 |
| 2023 | 0.005 |
| 2024 | 0.001 |
| 2025 | 0.003 |
| 2026 | 0.004 |
| 2027 | 0.005 |
| 2028 | 0.004 |
| 2029 | 0.005 |
| 2030 | 0.002 |
| 2031 | 0.002 |
| 2032 | 0.004 |
| 2033 | 0.001 |
| 2034 | 0.003 |
| 2035 | 0.008 |
| 2036 | 0.004 |
| 2037 | 0.003 |
| 2038 | 0.003 |
| 2039 | 0.007 |
| 2040 | 0.002 |
| 2041 | 0.003 |
| 2042 | 0.003 |
| 2043 | 0.002 |
| 2044 | 0.003 |
| 2045 | 0.003 |
| 2046 | 0.003 |
| 2047 | 0.006 |
| 2048 | 0.003 |
| 2049 | 0.005 |
| 2050 | 0.007 |
| 2051 | 0.004 |
| 2052 | 0.003 |
| 2053 | 0.002 |
| 2054 | 0.007 |
| 2055 | 0.003 |
| 2056 | 0.006 |
| 2057 | 0.002 |
| 2058 | 0.003 |
| 2059 | 0.006 |
| 2060 | 0.005 |
| 2061 | 0.002 |
| 2062 | 0.004 |
| 2063 | 0.004 |
| 2064 | 0.004 |
| 2065 | 0.002 |
| 2066 | 0.004 |
| 2067 | 0.008 |
| 2068 | 0.003 |
| 2069 | 0.003 |
| 2070 | 0.006 |
| 2071 | 0.007 |
| 2072 | 0.002 |
| 2073 | 0.005 |
| 2074 | 0.006 |
| 2075 | 0.005 |
| 2076 | 0.002 |
| 2077 | 0.001 |
| 2078 | 0.002 |
| 2079 | 0.009 |
| 2080 | 0.006 |
| 2081 | 0.002 |
| 2082 | 0.006 |
| 2083 | 0.004 |
| 2084 | 0.003 |
| 2085 | 0.003 |
| 2086 | 0.003 |
| 2087 | 0.004 |
| 2088 | 0.003 |
| 2089 | 0.003 |
| 2090 | 0.004 |
| 2091 | 0.003 |
| 2092 | 0.007 |
| 2093 | 0.001 |
| 2094 | 0.006 |
| 2095 | 0.002 |
| 2096 | 0.006 |
| 2097 | 0.001 |
| 2098 | 0.002 |
| 2099 | 0.005 |
| 2100 | 0.002 |
| 2101 | 0.01 |
| 2102 | 0.002 |
| 2103 | 0.006 |
| 2104 | 0.006 |
| 2105 | 0.001 |
| 2106 | 0.001 |
| 2107 | 0.003 |
| 2108 | 0.002 |
| 2109 | 0.004 |
| 2110 | 0.001 |
| 2111 | 0.003 |
| 2112 | 0.007 |
| 2113 | 0 |
| 2114 | 0.006 |
| 2115 | 0.002 |
| 2116 | 0.006 |
| 2117 | 0.003 |
| 2118 | 0.005 |
| 2119 | 0.003 |
| 2120 | 0.003 |
| 2121 | 0.005 |
| 2122 | 0.001 |
| 2123 | 0.006 |
| 2124 | 0.004 |
| 2125 | 0.005 |
| 2126 | 0.006 |
| 2127 | 0.002 |
| 2128 | 0.006 |
| 2129 | 0.004 |
| 2130 | 0.003 |
| 2131 | 0.006 |
| 2132 | 0.005 |
| 2133 | 0.004 |
| 2134 | 0.005 |
| 2135 | 0.002 |
| 2136 | 0.003 |
| 2137 | 0.003 |
| 2138 | 0.009 |
| 2139 | 0.011 |
| 2140 | 0.006 |
| 2141 | 0.01 |
| 2142 | 0.005 |
| 2143 | 0.002 |
| 2144 | 0.003 |
| 2145 | 0.004 |
| 2146 | 0.007 |
| 2147 | 0.006 |
| 2148 | 0.001 |
| 2149 | 0.005 |
| 2150 | 0.005 |
| 2151 | 0.003 |
| 2152 | 0.004 |
| 2153 | 0.005 |
| 2154 | 0.005 |
| 2155 | 0.004 |
| 2156 | 0.003 |
| 2157 | 0.004 |
| 2158 | 0.003 |
| 2159 | 0.004 |
| 2160 | 0.001 |
| 2161 | 0.007 |
| 2162 | 0.006 |
| 2163 | 0.011 |
| 2164 | 0.003 |
| 2165 | 0.002 |
| 2166 | 0.004 |
| 2167 | 0.01 |
| 2168 | 0.005 |
| 2169 | 0.003 |
| 2170 | 0.003 |
| 2171 | 0.002 |
| 2172 | 0.002 |
| 2173 | 0.005 |
| 2174 | 0.005 |
| 2175 | 0.004 |
| 2176 | 0.002 |
| 2177 | 0.006 |
| 2178 | 0.005 |
| 2179 | 0.004 |
| 2180 | 0.003 |
| 2181 | 0.007 |
| 2182 | 0.006 |
| 2183 | 0.005 |
| 2184 | 0.004 |
| 2185 | 0.002 |
| 2186 | 0.002 |
| 2187 | 0.004 |
| 2188 | 0.003 |
| 2189 | 0.002 |
| 2190 | 0.009 |
| 2191 | 0.005 |
| 2192 | 0.006 |
| 2193 | 0.005 |
| 2194 | 0.004 |
| 2195 | 0.002 |
| 2196 | 0.003 |
| 2197 | 0.004 |
| 2198 | 0.006 |
| 2199 | 0.017 |
| 2200 | 0.002 |
| 2201 | 0.002 |
| 2202 | 0.002 |
| 2203 | 0.006 |
| 2204 | 0.002 |
| 2205 | 0.005 |
| 2206 | 0.006 |
| 2207 | 0.006 |
| 2208 | 0.004 |
| 2209 | 0.002 |
| 2210 | 0.003 |
| 2211 | 0.004 |
| 2212 | 0.004 |
| 2213 | 0.003 |
| 2214 | 0.004 |
| 2215 | 0.003 |
| 2216 | 0.002 |
| 2217 | 0.001 |
| 2218 | 0.004 |
| 2219 | 0.004 |
| 2220 | 0.001 |
| 2221 | 0.003 |
| 2222 | 0.007 |
| 2223 | 0.004 |
| 2224 | 0.001 |
| 2225 | 0.004 |
| 2226 | 0.003 |
| 2227 | 0.004 |
| 2228 | 0.003 |
| 2229 | 0.006 |
| 2230 | 0.005 |
| 2231 | 0.004 |
| 2232 | 0.003 |
| 2233 | 0.003 |
| 2234 | 0.001 |
| 2235 | 0.008 |
| 2236 | 0.008 |
| 2237 | 0.002 |
| 2238 | 0.004 |
| 2239 | 0.007 |
| 2240 | 0.003 |
| 2241 | 0.004 |
| 2242 | 0.004 |
| 2243 | 0.004 |
| 2244 | 0.002 |
| 2245 | 0.002 |
| 2246 | 0.005 |
| 2247 | 0.013 |
| 2248 | 0.003 |
| 2249 | 0.004 |
| 2250 | 0.003 |
| 2251 | 0.002 |
| 2252 | 0.002 |
| 2253 | 0.005 |
| 2254 | 0.004 |
| 2255 | 0.008 |
| 2256 | 0.003 |
| 2257 | 0.002 |
| 2258 | 0.003 |
| 2259 | 0.002 |
| 2260 | 0.006 |
| 2261 | 0.004 |
| 2262 | 0.005 |
| 2263 | 0.01 |
| 2264 | 0.002 |
| 2265 | 0.003 |
| 2266 | 0.005 |
| 2267 | 0.006 |
| 2268 | 0.003 |
| 2269 | 0 |
| 2270 | 0.007 |
| 2271 | 0.005 |
| 2272 | 0.004 |
| 2273 | 0.001 |
| 2274 | 0.002 |
| 2275 | 0.008 |
| 2276 | 0.003 |
| 2277 | 0.004 |
| 2278 | 0.004 |
| 2279 | 0.008 |
| 2280 | 0.003 |
| 2281 | 0.006 |
| 2282 | 0.002 |
| 2283 | 0.003 |
| 2284 | 0.002 |
| 2285 | 0.001 |
| 2286 | 0.005 |
| 2287 | 0.006 |
| 2288 | 0.001 |
| 2289 | 0.002 |
| 2290 | 0.003 |
| 2291 | 0.003 |
| 2292 | 0.002 |
| 2293 | 0.002 |
| 2294 | 0.005 |
| 2295 | 0.006 |
| 2296 | 0.003 |
| 2297 | 0.001 |
| 2298 | 0.001 |
| 2299 | 0.006 |
| 2300 | 0.004 |
| 2301 | 0.004 |
| 2302 | 0.005 |
| 2303 | 0.002 |
| 2304 | 0.002 |
| 2305 | 0.006 |
| 2306 | 0.005 |
| 2307 | 0.007 |
| 2308 | 0.001 |
| 2309 | 0.004 |
| 2310 | 0.005 |
| 2311 | 0.004 |
| 2312 | 0.001 |
| 2313 | 0.002 |
| 2314 | 0.002 |
| 2315 | 0.005 |
| 2316 | 0.003 |
| 2317 | 0.002 |
| 2318 | 0.005 |
| 2319 | 0.004 |
| 2320 | 0.003 |
| 2321 | 0.002 |
| 2322 | 0.002 |
| 2323 | 0.001 |
| 2324 | 0.002 |
| 2325 | 0.003 |
| 2326 | 0.004 |
| 2327 | 0.008 |
| 2328 | 0.002 |
| 2329 | 0.003 |
| 2330 | 0.003 |
| 2331 | 0.006 |
| 2332 | 0.002 |
| 2333 | 0.005 |
| 2334 | 0.006 |
| 2335 | 0.005 |
| 2336 | 0.004 |
| 2337 | 0.003 |
| 2338 | 0.001 |
| 2339 | 0.002 |
| 2340 | 0.006 |
| 2341 | 0.002 |
| 2342 | 0.004 |
| 2343 | 0.003 |
| 2344 | 0.002 |
| 2345 | 0.003 |
| 2346 | 0.002 |
| 2347 | 0.002 |
| 2348 | 0.002 |
| 2349 | 0.002 |
| 2350 | 0.003 |
| 2351 | 0.002 |
| 2352 | 0.005 |
| 2353 | 0.005 |
| 2354 | 0.003 |
| 2355 | 0.009 |
| 2356 | 0.007 |
| 2357 | 0.004 |
| 2358 | 0.004 |
| 2359 | 0.005 |
| 2360 | 0.007 |
| 2361 | 0.001 |
| 2362 | 0.001 |
| 2363 | 0.004 |
| 2364 | 0.006 |
| 2365 | 0.003 |
| 2366 | 0.002 |
| 2367 | 0.011 |
| 2368 | 0.003 |
| 2369 | 0.001 |
| 2370 | 0.002 |
| 2371 | 0.002 |
| 2372 | 0.004 |
| 2373 | 0.002 |
| 2374 | 0.005 |
| 2375 | 0.004 |
| 2376 | 0.003 |
| 2377 | 0.005 |
| 2378 | 0.002 |
| 2379 | 0.003 |
| 2380 | 0.008 |
| 2381 | 0.003 |
| 2382 | 0.003 |
| 2383 | 0.01 |
| 2384 | 0.015 |
| 2385 | 0.004 |
| 2386 | 0.004 |
| 2387 | 0.002 |
| 2388 | 0.006 |
| 2389 | 0.002 |
| 2390 | 0.005 |
| 2391 | 0.003 |
| 2392 | 0.002 |
| 2393 | 0.002 |
| 2394 | 0.001 |
| 2395 | 0.001 |
| 2396 | 0.004 |
| 2397 | 0.003 |
| 2398 | 0.005 |
| 2399 | 0.006 |
| 2400 | 0.004 |
| 2401 | 0.005 |
| 2402 | 0.011 |
| 2403 | 0.003 |
| 2404 | 0.002 |
| 2405 | 0.002 |
| 2406 | 0.002 |
| 2407 | 0.004 |
| 2408 | 0.004 |
| 2409 | 0.001 |
| 2410 | 0.005 |
| 2411 | 0.004 |
| 2412 | 0.003 |
| 2413 | 0.003 |
| 2414 | 0.002 |
| 2415 | 0.005 |
| 2416 | 0.003 |
| 2417 | 0.003 |
| 2418 | 0.005 |
| 2419 | 0.003 |
| 2420 | 0.004 |
| 2421 | 0.007 |
| 2422 | 0.007 |
| 2423 | 0.012 |
| 2424 | 0.004 |
| 2425 | 0 |
| 2426 | 0.002 |
| 2427 | 0.004 |
| 2428 | 0.003 |
| 2429 | 0.003 |
| 2430 | 0.007 |
| 2431 | 0.001 |
| 2432 | 0.003 |
| 2433 | 0.004 |
| 2434 | 0.005 |
| 2435 | 0.001 |
| 2436 | 0.003 |
| 2437 | 0.004 |
| 2438 | 0.004 |
| 2439 | 0.005 |
| 2440 | 0.005 |
| 2441 | 0.003 |
| 2442 | 0.005 |
| 2443 | 0.003 |
| 2444 | 0.004 |
| 2445 | 0.01 |
| 2446 | 0.01 |
| 2447 | 0.008 |
| 2448 | 0.005 |
| 2449 | 0.004 |
| 2450 | 0.006 |
| 2451 | 0.006 |
| 2452 | 0.007 |
| 2453 | 0.005 |
| 2454 | 0.003 |
| 2455 | 0.002 |
| 2456 | 0.008 |
| 2457 | 0.01 |
| 2458 | 0.006 |
| 2459 | 0.003 |
| 2460 | 0.004 |
| 2461 | 0.002 |
| 2462 | 0.001 |
| 2463 | 0.003 |
| 2464 | 0.004 |
| 2465 | 0.005 |
| 2466 | 0.001 |
| 2467 | 0.003 |
| 2468 | 0.006 |
| 2469 | 0.004 |
| 2470 | 0.007 |
| 2471 | 0.012 |
| 2472 | 0.007 |
| 2473 | 0.007 |
| 2474 | 0.012 |
| 2475 | 0.001 |
| 2476 | 0.003 |
| 2477 | 0.005 |
| 2478 | 0.008 |
| 2479 | 0.003 |
| 2480 | 0.002 |
| 2481 | 0.001 |
| 2482 | 0.009 |
| 2483 | 0.004 |
| 2484 | 0.003 |
| 2485 | 0.003 |
| 2486 | 0.001 |
| 2487 | 0.002 |
| 2488 | 0.006 |
| 2489 | 0.001 |
| 2490 | 0.004 |
| 2491 | 0.004 |
| 2492 | 0.006 |
| 2493 | 0.002 |
| 2494 | 0.008 |
| 2495 | 0.011 |
| 2496 | 0.002 |
| 2497 | 0.006 |
| 2498 | 0.006 |
| 2499 | 0.007 |
| 2500 | 0.002 |
| 2501 | 0.005 |
| 2502 | 0.008 |
| 2503 | 0.013 |
| 2504 | 0.003 |
| 2505 | 0.002 |
| 2506 | 0.003 |
| 2507 | 0.006 |
| 2508 | 0.002 |
| 2509 | 0.001 |
| 2510 | 0.003 |
| 2511 | 0.007 |
| 2512 | 0.003 |
| 2513 | 0.008 |
| 2514 | 0.008 |
| 2515 | 0.007 |
| 2516 | 0.002 |
| 2517 | 0.001 |
| 2518 | 0.003 |
| 2519 | 0.006 |
| 2520 | 0.002 |
| 2521 | 0.002 |
| 2522 | 0.006 |
| 2523 | 0.006 |
| 2524 | 0.003 |
| 2525 | 0.006 |
| 2526 | 0.006 |
| 2527 | 0.005 |
| 2528 | 0.003 |
| 2529 | 0.005 |
| 2530 | 0.003 |
| 2531 | 0.004 |
| 2532 | 0.004 |
| 2533 | 0.005 |
| 2534 | 0.005 |
| 2535 | 0.004 |
| 2536 | 0.002 |
| 2537 | 0.005 |
| 2538 | 0.002 |
| 2539 | 0.004 |
| 2540 | 0.002 |
| 2541 | 0.005 |
| 2542 | 0.006 |
| 2543 | 0.003 |
| 2544 | 0.002 |
| 2545 | 0.002 |
| 2546 | 0.005 |
| 2547 | 0.008 |
| 2548 | 0.002 |
| 2549 | 0.003 |
| 2550 | 0.005 |
| 2551 | 0.002 |
| 2552 | 0.002 |
| 2553 | 0.005 |
| 2554 | 0.002 |
| 2555 | 0.002 |
| 2556 | 0.001 |
| 2557 | 0.005 |
| 2558 | 0.011 |
| 2559 | 0.007 |
| 2560 | 0.003 |
| 2561 | 0.003 |
| 2562 | 0.006 |
| 2563 | 0.005 |
| 2564 | 0.003 |
| 2565 | 0.002 |
| 2566 | 0.007 |
| 2567 | 0.001 |
| 2568 | 0.003 |
| 2569 | 0.004 |
| 2570 | 0.002 |
| 2571 | 0.005 |
| 2572 | 0.002 |
| 2573 | 0.001 |
| 2574 | 0.002 |
| 2575 | 0.004 |
| 2576 | 0.004 |
| 2577 | 0.004 |
| 2578 | 0.01 |
| 2579 | 0.007 |
| 2580 | 0.003 |
| 2581 | 0.008 |
| 2582 | 0.006 |
| 2583 | 0.006 |
| 2584 | 0.004 |
| 2585 | 0.004 |
| 2586 | 0.007 |
| 2587 | 0.011 |
| 2588 | 0.003 |
| 2589 | 0.002 |
| 2590 | 0.007 |
| 2591 | 0.005 |
| 2592 | 0.004 |
| 2593 | 0.001 |
| 2594 | 0.008 |
| 2595 | 0.011 |
| 2596 | 0.002 |
| 2597 | 0.009 |
| 2598 | 0.007 |
| 2599 | 0.005 |
| 2600 | 0.003 |
| 2601 | 0.01 |
| 2602 | 0.004 |
| 2603 | 0.002 |
| 2604 | 0.003 |
| 2605 | 0.002 |
| 2606 | 0.005 |
| 2607 | 0.005 |
| 2608 | 0.002 |
| 2609 | 0.005 |
| 2610 | 0.005 |
| 2611 | 0.006 |
| 2612 | 0.004 |
| 2613 | 0.002 |
| 2614 | 0.009 |
| 2615 | 0.005 |
| 2616 | 0.002 |
| 2617 | 0.005 |
| 2618 | 0.006 |
| 2619 | 0.005 |
| 2620 | 0.003 |
| 2621 | 0.007 |
| 2622 | 0.008 |
| 2623 | 0.006 |
| 2624 | 0.003 |
| 2625 | 0.002 |
| 2626 | 0.008 |
| 2627 | 0.009 |
| 2628 | 0.007 |
| 2629 | 0.002 |
| 2630 | 0.003 |
| 2631 | 0.005 |
| 2632 | 0.003 |
| 2633 | 0.003 |
| 2634 | 0.002 |
| 2635 | 0.003 |
| 2636 | 0.003 |
| 2637 | 0.001 |
| 2638 | 0.001 |
| 2639 | 0.003 |
| 2640 | 0.002 |
| 2641 | 0.001 |
| 2642 | 0.005 |
| 2643 | 0.002 |
| 2644 | 0.005 |
| 2645 | 0.001 |
| 2646 | 0.004 |
| 2647 | 0.009 |
| 2648 | 0.003 |
| 2649 | 0.004 |
| 2650 | 0.003 |
| 2651 | 0.006 |
| 2652 | 0.001 |
| 2653 | 0.004 |
| 2654 | 0.007 |
| 2655 | 0.012 |
| 2656 | 0.002 |
| 2657 | 0.005 |
| 2658 | 0.005 |
| 2659 | 0.005 |
| 2660 | 0.002 |
| 2661 | 0.002 |
| 2662 | 0.005 |
| 2663 | 0.003 |
| 2664 | 0.006 |
| 2665 | 0.008 |
| 2666 | 0.001 |
| 2667 | 0.003 |
| 2668 | 0.006 |
| 2669 | 0.003 |
| 2670 | 0.003 |
| 2671 | 0.004 |
| 2672 | 0.003 |
| 2673 | 0.003 |
| 2674 | 0.009 |
| 2675 | 0.007 |
| 2676 | 0.004 |
| 2677 | 0.002 |
| 2678 | 0 |
| 2679 | 0.005 |
| 2680 | 0.007 |
| 2681 | 0.003 |
| 2682 | 0.003 |
| 2683 | 0.01 |
| 2684 | 0.002 |
| 2685 | 0.002 |
| 2686 | 0.002 |
| 2687 | 0.004 |
| 2688 | 0.001 |
| 2689 | 0.002 |
| 2690 | 0.003 |
| 2691 | 0.005 |
| 2692 | 0.004 |
| 2693 | 0.001 |
| 2694 | 0.006 |
| 2695 | 0.002 |
| 2696 | 0.004 |
| 2697 | 0.003 |
| 2698 | 0.001 |
| 2699 | 0.001 |
| 2700 | 0.003 |
| 2701 | 0.003 |
| 2702 | 0.005 |
| 2703 | 0.006 |
| 2704 | 0.002 |
| 2705 | 0.002 |
| 2706 | 0.007 |
| 2707 | 0.005 |
| 2708 | 0.003 |
| 2709 | 0.002 |
| 2710 | 0.001 |
| 2711 | 0.002 |
| 2712 | 0.004 |
| 2713 | 0.009 |
| 2714 | 0.008 |
| 2715 | 0.005 |
| 2716 | 0.004 |
| 2717 | 0.003 |
| 2718 | 0.006 |
| 2719 | 0.006 |
| 2720 | 0.004 |
| 2721 | 0.004 |
| 2722 | 0.002 |
| 2723 | 0.006 |
| 2724 | 0.004 |
| 2725 | 0.007 |
| 2726 | 0.006 |
| 2727 | 0.005 |
| 2728 | 0.005 |
| 2729 | 0.008 |
| 2730 | 0.004 |
| 2731 | 0.005 |
| 2732 | 0.004 |
| 2733 | 0.002 |
| 2734 | 0.003 |
| 2735 | 0.012 |
| 2736 | 0.01 |
| 2737 | 0.004 |
| 2738 | 0.006 |
| 2739 | 0.007 |
| 2740 | 0.002 |
| 2741 | 0.008 |
| 2742 | 0.013 |
| 2743 | 0.002 |
| 2744 | 0.003 |
| 2745 | 0.003 |
| 2746 | 0.007 |
| 2747 | 0.004 |
| 2748 | 0.004 |
| 2749 | 0.008 |
| 2750 | 0.009 |
| 2751 | 0.008 |
| 2752 | 0.003 |
| 2753 | 0.002 |
| 2754 | 0.003 |
| 2755 | 0.001 |
| 2756 | 0.004 |
| 2757 | 0.007 |
| 2758 | 0.007 |
| 2759 | 0.006 |
| 2760 | 0.003 |
| 2761 | 0.003 |
| 2762 | 0.002 |
| 2763 | 0.003 |
| 2764 | 0.003 |
| 2765 | 0.005 |
| 2766 | 0.009 |
| 2767 | 0.004 |
| 2768 | 0.007 |
| 2769 | 0.002 |
| 2770 | 0.004 |
| 2771 | 0.005 |
| 2772 | 0.002 |
| 2773 | 0.004 |
| 2774 | 0.003 |
| 2775 | 0.003 |
| 2776 | 0.01 |
| 2777 | 0.001 |
| 2778 | 0.002 |
| 2779 | 0.006 |
| 2780 | 0.002 |
| 2781 | 0.002 |
| 2782 | 0.002 |
| 2783 | 0.003 |
| 2784 | 0.004 |
| 2785 | 0.002 |
| 2786 | 0.002 |
| 2787 | 0.004 |
| 2788 | 0.003 |
| 2789 | 0.002 |
| 2790 | 0.008 |
| 2791 | 0.005 |
| 2792 | 0.004 |
| 2793 | 0.005 |
| 2794 | 0.007 |
| 2795 | 0.008 |
| 2796 | 0 |
| 2797 | 0.003 |
| 2798 | 0.007 |
| 2799 | 0.003 |
| 2800 | 0.004 |
| 2801 | 0.003 |
| 2802 | 0.006 |
| 2803 | 0.003 |
| 2804 | 0.002 |
| 2805 | 0 |
| 2806 | 0.003 |
| 2807 | 0.006 |
| 2808 | 0.001 |
| 2809 | 0.003 |
| 2810 | 0.004 |
| 2811 | 0.012 |
| 2812 | 0.003 |
| 2813 | 0.003 |
| 2814 | 0.003 |
| 2815 | 0.005 |
| 2816 | 0.001 |
| 2817 | 0.005 |
| 2818 | 0.006 |
| 2819 | 0.008 |
| 2820 | 0.004 |
| 2821 | 0.002 |
| 2822 | 0.004 |
| 2823 | 0.005 |
| 2824 | 0.002 |
| 2825 | 0.002 |
| 2826 | 0.003 |
| 2827 | 0.005 |
| 2828 | 0.003 |
| 2829 | 0.003 |
| 2830 | 0.006 |
| 2831 | 0.005 |
| 2832 | 0.004 |
| 2833 | 0.005 |
| 2834 | 0.004 |
| 2835 | 0.004 |
| 2836 | 0.006 |
| 2837 | 0.005 |
| 2838 | 0.002 |
| 2839 | 0.002 |
| 2840 | 0.004 |
| 2841 | 0.004 |
| 2842 | 0.01 |
| 2843 | 0.009 |
| 2844 | 0.006 |
| 2845 | 0.002 |
| 2846 | 0.002 |
| 2847 | 0.004 |
| 2848 | 0.005 |
| 2849 | 0.003 |
| 2850 | 0.003 |
| 2851 | 0.006 |
| 2852 | 0.003 |
| 2853 | 0.003 |
| 2854 | 0.001 |
| 2855 | 0.006 |
| 2856 | 0.005 |
| 2857 | 0.003 |
| 2858 | 0.003 |
| 2859 | 0.003 |
| 2860 | 0.002 |
| 2861 | 0.003 |
| 2862 | 0.001 |
| 2863 | 0.007 |
| 2864 | 0.003 |
| 2865 | 0.005 |
| 2866 | 0.004 |
| 2867 | 0.002 |
| 2868 | 0.002 |
| 2869 | 0.002 |
| 2870 | 0.004 |
| 2871 | 0.003 |
| 2872 | 0.002 |
| 2873 | 0.004 |
| 2874 | 0.003 |
| 2875 | 0.011 |
| 2876 | 0.003 |
| 2877 | 0.005 |
| 2878 | 0.006 |
| 2879 | 0.008 |
| 2880 | 0.001 |
| 2881 | 0.002 |
| 2882 | 0.006 |
| 2883 | 0.004 |
| 2884 | 0.001 |
| 2885 | 0.001 |
| 2886 | 0.006 |
| 2887 | 0.004 |
| 2888 | 0.003 |
| 2889 | 0.004 |
| 2890 | 0.007 |
| 2891 | 0.005 |
| 2892 | 0.004 |
| 2893 | 0.003 |
| 2894 | 0.003 |
| 2895 | 0.006 |
| 2896 | 0.002 |
| 2897 | 0.002 |
| 2898 | 0.004 |
| 2899 | 0.007 |
| 2900 | 0.002 |
| 2901 | 0.003 |
| 2902 | 0.004 |
| 2903 | 0.006 |
| 2904 | 0.003 |
| 2905 | 0.003 |
| 2906 | 0.005 |
| 2907 | 0.007 |
| 2908 | 0.001 |
| 2909 | 0.002 |
| 2910 | 0.003 |
| 2911 | 0.004 |
| 2912 | 0.002 |
| 2913 | 0.004 |
| 2914 | 0.004 |
| 2915 | 0.006 |
| 2916 | 0 |
| 2917 | 0.002 |
| 2918 | 0.005 |
| 2919 | 0.009 |
| 2920 | 0.004 |
| 2921 | 0.003 |
| 2922 | 0.006 |
| 2923 | 0.01 |
| 2924 | 0.003 |
| 2925 | 0.004 |
| 2926 | 0.006 |
| 2927 | 0.003 |
| 2928 | 0.002 |
| 2929 | 0.003 |
| 2930 | 0.002 |
| 2931 | 0.006 |
| 2932 | 0.002 |
| 2933 | 0.004 |
| 2934 | 0.008 |
| 2935 | 0.004 |
| 2936 | 0.002 |
| 2937 | 0.004 |
| 2938 | 0.006 |
| 2939 | 0.004 |
| 2940 | 0.004 |
| 2941 | 0.004 |
| 2942 | 0.002 |
| 2943 | 0.006 |
| 2944 | 0.004 |
| 2945 | 0.002 |
| 2946 | 0.005 |
| 2947 | 0.004 |
| 2948 | 0.002 |
| 2949 | 0.002 |
| 2950 | 0.004 |
| 2951 | 0.005 |
| 2952 | 0.003 |
| 2953 | 0.002 |
| 2954 | 0.004 |
| 2955 | 0.006 |
| 2956 | 0.003 |
| 2957 | 0.003 |
| 2958 | 0.006 |
| 2959 | 0.005 |
| 2960 | 0.003 |
| 2961 | 0.001 |
| 2962 | 0.005 |
| 2963 | 0.003 |
| 2964 | 0.001 |
| 2965 | 0.003 |
| 2966 | 0.003 |
| 2967 | 0.003 |
| 2968 | 0.002 |
| 2969 | 0.003 |
| 2970 | 0.004 |
| 2971 | 0.006 |
| 2972 | 0.003 |
| 2973 | 0.004 |
| 2974 | 0.001 |
| 2975 | 0.008 |
| 2976 | 0.001 |
| 2977 | 0.004 |
| 2978 | 0.003 |
| 2979 | 0.002 |
| 2980 | 0.005 |
| 2981 | 0.004 |
| 2982 | 0.003 |
| 2983 | 0.001 |
| 2984 | 0.005 |
| 2985 | 0.002 |
| 2986 | 0.001 |
| 2987 | 0.002 |
| 2988 | 0.004 |
| 2989 | 0.003 |
| 2990 | 0.005 |
| 2991 | 0.004 |
| 2992 | 0.003 |
| 2993 | 0.002 |
| 2994 | 0.005 |
| 2995 | 0.004 |
| 2996 | 0.005 |
| 2997 | 0.004 |
| 2998 | 0.002 |
| 2999 | 0.004 |
| 3000 | 0.002 |
| 3001 | 0.002 |
| 3002 | 0.007 |
| 3003 | 0.01 |
| 3004 | 0.005 |
| 3005 | 0.002 |
| 3006 | 0.009 |
| 3007 | 0.008 |
| 3008 | 0.007 |
| 3009 | 0.003 |
| 3010 | 0.005 |
| 3011 | 0.009 |
| 3012 | 0.015 |
| 3013 | 0.008 |
| 3014 | 0.006 |
| 3015 | 0.001 |
| 3016 | 0.002 |
| 3017 | 0.001 |
| 3018 | 0.003 |
| 3019 | 0.003 |
| 3020 | 0.002 |
| 3021 | 0.003 |
| 3022 | 0.004 |
| 3023 | 0.002 |
| 3024 | 0.001 |
| 3025 | 0.002 |
| 3026 | 0.01 |
| 3027 | 0.009 |
| 3028 | 0.006 |
| 3029 | 0.004 |
| 3030 | 0.003 |
| 3031 | 0.004 |
| 3032 | 0.005 |
| 3033 | 0.004 |
| 3034 | 0.003 |
| 3035 | 0.002 |
| 3036 | 0.004 |
| 3037 | 0.004 |
| 3038 | 0.006 |
| 3039 | 0.006 |
| 3040 | 0.005 |
| 3041 | 0.003 |
| 3042 | 0.004 |
| 3043 | 0.002 |
| 3044 | 0.004 |
| 3045 | 0.006 |
| 3046 | 0.006 |
| 3047 | 0.007 |
| 3048 | 0.001 |
| 3049 | 0.005 |
| 3050 | 0.01 |
| 3051 | 0.006 |
| 3052 | 0.007 |
| 3053 | 0.011 |
| 3054 | 0.008 |
| 3055 | 0.003 |
| 3056 | 0.005 |
| 3057 | 0.006 |
| 3058 | 0.004 |
| 3059 | 0.007 |
| 3060 | 0.003 |
| 3061 | 0.004 |
| 3062 | 0.008 |
| 3063 | 0.006 |
| 3064 | 0.003 |
| 3065 | 0.002 |
| 3066 | 0.003 |
| 3067 | 0.002 |
| 3068 | 0.006 |
| 3069 | 0.003 |
| 3070 | 0.003 |
| 3071 | 0.006 |
| 3072 | 0.002 |
| 3073 | 0.002 |
| 3074 | 0.002 |
| 3075 | 0.007 |
| 3076 | 0.007 |
| 3077 | 0.001 |
| 3078 | 0.002 |
| 3079 | 0.005 |
| 3080 | 0.008 |
| 3081 | 0.002 |
| 3082 | 0.002 |
| 3083 | 0.002 |
| 3084 | 0.003 |
| 3085 | 0.001 |
| 3086 | 0.003 |
| 3087 | 0.005 |
| 3088 | 0.005 |
| 3089 | 0.004 |
| 3090 | 0.007 |
| 3091 | 0.009 |
| 3092 | 0.005 |
| 3093 | 0.003 |
| 3094 | 0.004 |
| 3095 | 0.003 |
| 3096 | 0.002 |
| 3097 | 0.004 |
| 3098 | 0.006 |
| 3099 | 0.005 |
| 3100 | 0.003 |
| 3101 | 0.005 |
| 3102 | 0.003 |
| 3103 | 0.003 |
| 3104 | 0.003 |
| 3105 | 0.006 |
| 3106 | 0.006 |
| 3107 | 0.008 |
| 3108 | 0.002 |
| 3109 | 0.001 |
| 3110 | 0.003 |
| 3111 | 0.008 |
| 3112 | 0.003 |
| 3113 | 0.004 |
| 3114 | 0.004 |
| 3115 | 0.007 |
| 3116 | 0.004 |
| 3117 | 0.002 |
| 3118 | 0.005 |
| 3119 | 0.008 |
| 3120 | 0.001 |
| 3121 | 0.004 |
| 3122 | 0.002 |
| 3123 | 0.01 |
| 3124 | 0.007 |
| 3125 | 0.006 |
| 3126 | 0.009 |
| 3127 | 0.01 |
| 3128 | 0.001 |
| 3129 | 0.003 |
| 3130 | 0.003 |
| 3131 | 0.005 |
| 3132 | 0.002 |
| 3133 | 0.003 |
| 3134 | 0.003 |
| 3135 | 0.002 |
| 3136 | 0.002 |
| 3137 | 0.002 |
| 3138 | 0.007 |
| 3139 | 0.003 |
| 3140 | 0.005 |
| 3141 | 0.003 |
| 3142 | 0.004 |
| 3143 | 0.007 |
| 3144 | 0.002 |
| 3145 | 0.004 |
| 3146 | 0.002 |
| 3147 | 0.003 |
| 3148 | 0.002 |
| 3149 | 0.003 |
| 3150 | 0.003 |
| 3151 | 0.006 |
| 3152 | 0.004 |
| 3153 | 0.003 |
| 3154 | 0.012 |
| 3155 | 0.012 |
| 3156 | 0.005 |
| 3157 | 0.002 |
| 3158 | 0.005 |
| 3159 | 0.002 |
| 3160 | 0.002 |
| 3161 | 0.002 |
| 3162 | 0.007 |
| 3163 | 0.006 |
| 3164 | 0.004 |
| 3165 | 0.002 |
| 3166 | 0.005 |
| 3167 | 0.011 |
| 3168 | 0.002 |
| 3169 | 0.005 |
| 3170 | 0.004 |
| 3171 | 0.003 |
| 3172 | 0.001 |
| 3173 | 0.002 |
| 3174 | 0.005 |
| 3175 | 0.005 |
| 3176 | 0.004 |
| 3177 | 0.006 |
| 3178 | 0.001 |
| 3179 | 0.002 |
| 3180 | 0.003 |
| 3181 | 0.002 |
| 3182 | 0.005 |
| 3183 | 0.006 |
| 3184 | 0.004 |
| 3185 | 0.004 |
| 3186 | 0.004 |
| 3187 | 0.01 |
| 3188 | 0.003 |
| 3189 | 0.001 |
| 3190 | 0.003 |
| 3191 | 0.01 |
| 3192 | 0.003 |
| 3193 | 0.003 |
| 3194 | 0.004 |
| 3195 | 0.007 |
| 3196 | 0 |
| 3197 | 0.002 |
| 3198 | 0.005 |
| 3199 | 0.006 |
| 3200 | 0.005 |
| 3201 | 0.003 |
| 3202 | 0.002 |
| 3203 | 0.004 |
| 3204 | 0.015 |
| 3205 | 0.006 |
| 3206 | 0.002 |
| 3207 | 0.003 |
| 3208 | 0.002 |
| 3209 | 0.001 |
| 3210 | 0.002 |
| 3211 | 0.004 |
| 3212 | 0.01 |
| 3213 | 0.005 |
| 3214 | 0.005 |
| 3215 | 0.006 |
| 3216 | 0.002 |
| 3217 | 0.002 |
| 3218 | 0.005 |
| 3219 | 0.008 |
| 3220 | 0.002 |
| 3221 | 0.003 |
| 3222 | 0.004 |
| 3223 | 0.007 |
| 3224 | 0.002 |
| 3225 | 0.002 |
| 3226 | 0.005 |
| 3227 | 0.004 |
| 3228 | 0.002 |
| 3229 | 0.004 |
| 3230 | 0.006 |
| 3231 | 0.003 |
| 3232 | 0.004 |
| 3233 | 0.002 |
| 3234 | 0.003 |
| 3235 | 0.006 |
| 3236 | 0.002 |
| 3237 | 0.003 |
| 3238 | 0.004 |
| 3239 | 0.007 |
| 3240 | 0.005 |
| 3241 | 0.008 |
| 3242 | 0.004 |
| 3243 | 0.004 |
| 3244 | 0.005 |
| 3245 | 0.004 |
| 3246 | 0.001 |
| 3247 | 0.006 |
| 3248 | 0.005 |
| 3249 | 0.004 |
| 3250 | 0.001 |
| 3251 | 0.002 |
| 3252 | 0.003 |
| 3253 | 0.007 |
| 3254 | 0.003 |
| 3255 | 0.002 |
| 3256 | 0.006 |
| 3257 | 0.004 |
| 3258 | 0.007 |
| 3259 | 0.008 |
| 3260 | 0.003 |
| 3261 | 0.002 |
| 3262 | 0.005 |
| 3263 | 0.003 |
| 3264 | 0.003 |
| 3265 | 0.004 |
| 3266 | 0.004 |
| 3267 | 0.005 |
| 3268 | 0.002 |
| 3269 | 0.001 |
| 3270 | 0.004 |
| 3271 | 0.004 |
| 3272 | 0.004 |
| 3273 | 0.006 |
| 3274 | 0.003 |
| 3275 | 0.007 |
| 3276 | 0.006 |
| 3277 | 0.003 |
| 3278 | 0.002 |
| 3279 | 0.008 |
| 3280 | 0.005 |
| 3281 | 0.002 |
| 3282 | 0.005 |
| 3283 | 0.003 |
| 3284 | 0.004 |
| 3285 | 0.003 |
| 3286 | 0.005 |
| 3287 | 0.006 |
| 3288 | 0.003 |
| 3289 | 0.003 |
| 3290 | 0.004 |
| 3291 | 0.005 |
| 3292 | 0.005 |
| 3293 | 0.006 |
| 3294 | 0.004 |
| 3295 | 0.003 |
| 3296 | 0.004 |
| 3297 | 0.001 |
| 3298 | 0.005 |
| 3299 | 0.004 |
| 3300 | 0.004 |
| 3301 | 0.008 |
| 3302 | 0.005 |
| 3303 | 0.004 |
| 3304 | 0.002 |
| 3305 | 0.004 |
| 3306 | 0.001 |
| 3307 | 0.005 |
| 3308 | 0.005 |
| 3309 | 0.004 |
| 3310 | 0.01 |
| 3311 | 0.005 |
| 3312 | 0.004 |
| 3313 | 0.003 |
| 3314 | 0.007 |
| 3315 | 0.003 |
| 3316 | 0.004 |
| 3317 | 0.004 |
| 3318 | 0.001 |
| 3319 | 0.002 |
| 3320 | 0.003 |
| 3321 | 0.002 |
| 3322 | 0.002 |
| 3323 | 0.009 |
| 3324 | 0.002 |
| 3325 | 0.005 |
| 3326 | 0.001 |
| 3327 | 0.005 |
| 3328 | 0.001 |
| 3329 | 0.004 |
| 3330 | 0.006 |
| 3331 | 0.003 |
| 3332 | 0.002 |
| 3333 | 0.006 |
| 3334 | 0.006 |
| 3335 | 0.005 |
| 3336 | 0.003 |
| 3337 | 0.004 |
| 3338 | 0.006 |
| 3339 | 0.002 |
| 3340 | 0.002 |
| 3341 | 0.003 |
| 3342 | 0.007 |
| 3343 | 0.005 |
| 3344 | 0.008 |
| 3345 | 0.006 |
| 3346 | 0.005 |
| 3347 | 0.004 |
| 3348 | 0.004 |
| 3349 | 0.006 |
| 3350 | 0.006 |
| 3351 | 0.006 |
| 3352 | 0.005 |
| 3353 | 0.007 |
| 3354 | 0.009 |
| 3355 | 0.005 |
| 3356 | 0.004 |
| 3357 | 0.002 |
| 3358 | 0.002 |
| 3359 | 0.003 |
| 3360 | 0.003 |
| 3361 | 0.003 |
| 3362 | 0.007 |
| 3363 | 0.003 |
| 3364 | 0.007 |
| 3365 | 0.003 |
| 3366 | 0.005 |
| 3367 | 0.003 |
| 3368 | 0.008 |
| 3369 | 0.01 |
| 3370 | 0.01 |
| 3371 | 0.011 |
| 3372 | 0.004 |
| 3373 | 0.006 |
| 3374 | 0.004 |
| 3375 | 0.003 |
| 3376 | 0.004 |
| 3377 | 0.005 |
| 3378 | 0.004 |
| 3379 | 0.002 |
| 3380 | 0.008 |
| 3381 | 0.002 |
| 3382 | 0.003 |
| 3383 | 0.003 |
| 3384 | 0.005 |
| 3385 | 0.002 |
| 3386 | 0.003 |
| 3387 | 0.006 |
| 3388 | 0.009 |
| 3389 | 0.005 |
| 3390 | 0.003 |
| 3391 | 0.005 |
| 3392 | 0.003 |
| 3393 | 0.003 |
| 3394 | 0.008 |
| 3395 | 0.005 |
| 3396 | 0.002 |
| 3397 | 0.005 |
| 3398 | 0.005 |
| 3399 | 0.003 |
| 3400 | 0.003 |
| 3401 | 0.009 |
| 3402 | 0.002 |
| 3403 | 0.003 |
| 3404 | 0.003 |
| 3405 | 0.004 |
| 3406 | 0.003 |
| 3407 | 0.002 |
| 3408 | 0.003 |
| 3409 | 0.002 |
| 3410 | 0.003 |
| 3411 | 0.005 |
| 3412 | 0.001 |
| 3413 | 0.003 |
| 3414 | 0.005 |
| 3415 | 0.004 |
| 3416 | 0.002 |
| 3417 | 0.001 |
| 3418 | 0.003 |
| 3419 | 0.006 |
| 3420 | 0.004 |
| 3421 | 0.004 |
| 3422 | 0.003 |
| 3423 | 0.003 |
| 3424 | 0.002 |
| 3425 | 0.002 |
| 3426 | 0.001 |
| 3427 | 0.003 |
| 3428 | 0.002 |
| 3429 | 0.003 |
| 3430 | 0.003 |
| 3431 | 0.008 |
| 3432 | 0.002 |
| 3433 | 0.001 |
| 3434 | 0.008 |
| 3435 | 0.007 |
| 3436 | 0.004 |
| 3437 | 0.002 |
| 3438 | 0.008 |
| 3439 | 0.005 |
| 3440 | 0.002 |
| 3441 | 0.003 |
| 3442 | 0.002 |
| 3443 | 0.003 |
| 3444 | 0.005 |
| 3445 | 0.002 |
| 3446 | 0.007 |
| 3447 | 0.008 |
| 3448 | 0.004 |
| 3449 | 0.002 |
| 3450 | 0.006 |
| 3451 | 0.004 |
| 3452 | 0.003 |
| 3453 | 0.004 |
| 3454 | 0.005 |
| 3455 | 0.002 |
| 3456 | 0.001 |
| 3457 | 0.002 |
| 3458 | 0.007 |
| 3459 | 0.008 |
| 3460 | 0.002 |
| 3461 | 0.001 |
| 3462 | 0.003 |
| 3463 | 0.007 |
| 3464 | 0.002 |
| 3465 | 0.003 |
| 3466 | 0.007 |
| 3467 | 0.006 |
| 3468 | 0.002 |
| 3469 | 0.004 |
| 3470 | 0.005 |
| 3471 | 0.003 |
| 3472 | 0.002 |
| 3473 | 0.003 |
| 3474 | 0.006 |
| 3475 | 0.002 |
| 3476 | 0.003 |
| 3477 | 0.006 |
| 3478 | 0.003 |
| 3479 | 0.005 |
| 3480 | 0.003 |
| 3481 | 0.001 |
| 3482 | 0.005 |
| 3483 | 0.007 |
| 3484 | 0.002 |
| 3485 | 0.002 |
| 3486 | 0.002 |
| 3487 | 0.005 |
| 3488 | 0.001 |
| 3489 | 0.003 |
| 3490 | 0.006 |
| 3491 | 0.007 |
| 3492 | 0.002 |
| 3493 | 0.003 |
| 3494 | 0.004 |
| 3495 | 0.004 |
| 3496 | 0.002 |
| 3497 | 0.003 |
| 3498 | 0.002 |
| 3499 | 0.012 |
| 3500 | 0.003 |
| 3501 | 0.006 |
| 3502 | 0.009 |
| 3503 | 0.005 |
| 3504 | 0.001 |
| 3505 | 0.005 |
| 3506 | 0.005 |
| 3507 | 0.007 |
| 3508 | 0.003 |
| 3509 | 0.003 |
| 3510 | 0.006 |
| 3511 | 0.004 |
| 3512 | 0.002 |
| 3513 | 0.003 |
| 3514 | 0.006 |
| 3515 | 0.006 |
| 3516 | 0.003 |
| 3517 | 0.003 |
| 3518 | 0.006 |
| 3519 | 0.002 |
| 3520 | 0.004 |
| 3521 | 0.005 |
| 3522 | 0.007 |
| 3523 | 0.005 |
| 3524 | 0.001 |
| 3525 | 0.003 |
| 3526 | 0.002 |
| 3527 | 0.004 |
| 3528 | 0.003 |
| 3529 | 0.007 |
| 3530 | 0.006 |
| 3531 | 0.007 |
| 3532 | 0.002 |
| 3533 | 0.002 |
| 3534 | 0.008 |
| 3535 | 0.002 |
| 3536 | 0.001 |
| 3537 | 0.002 |
| 3538 | 0.002 |
| 3539 | 0.006 |
| 3540 | 0.002 |
| 3541 | 0.006 |
| 3542 | 0.005 |
| 3543 | 0.003 |
| 3544 | 0.002 |
| 3545 | 0.003 |
| 3546 | 0.003 |
| 3547 | 0.009 |
| 3548 | 0.003 |
| 3549 | 0.002 |
| 3550 | 0.003 |
| 3551 | 0.006 |
| 3552 | 0.003 |
| 3553 | 0.006 |
| 3554 | 0.006 |
| 3555 | 0.004 |
| 3556 | 0.001 |
| 3557 | 0.002 |
| 3558 | 0.005 |
| 3559 | 0.005 |
| 3560 | 0.001 |
| 3561 | 0.004 |
| 3562 | 0.003 |
| 3563 | 0.004 |
| 3564 | 0.003 |
| 3565 | 0.001 |
| 3566 | 0.005 |
| 3567 | 0.003 |
| 3568 | 0.005 |
| 3569 | 0.002 |
| 3570 | 0.004 |
| 3571 | 0.002 |
| 3572 | 0.003 |
| 3573 | 0.005 |
| 3574 | 0.005 |
| 3575 | 0.002 |
| 3576 | 0.006 |
| 3577 | 0.004 |
| 3578 | 0.006 |
| 3579 | 0.003 |
| 3580 | 0.001 |
| 3581 | 0.005 |
| 3582 | 0.008 |
| 3583 | 0.007 |
| 3584 | 0.008 |
| 3585 | 0.003 |
| 3586 | 0.005 |
| 3587 | 0.003 |
| 3588 | 0.006 |
| 3589 | 0.002 |
| 3590 | 0.002 |
| 3591 | 0.004 |
| 3592 | 0.004 |
| 3593 | 0.001 |
| 3594 | 0.003 |
| 3595 | 0.004 |
| 3596 | 0.009 |
| 3597 | 0.002 |
| 3598 | 0.003 |
| 3599 | 0.002 |
| 3600 | 0.002 |
| 3601 | 0.003 |
| 3602 | 0.003 |
| 3603 | 0.005 |
| 3604 | 0.008 |
| 3605 | 0.003 |
| 3606 | 0.006 |
| 3607 | 0.002 |
| 3608 | 0.006 |
| 3609 | 0.008 |
| 3610 | 0.002 |
| 3611 | 0.003 |
| 3612 | 0.002 |
| 3613 | 0.001 |
| 3614 | 0.003 |
| 3615 | 0.003 |
| 3616 | 0.005 |
| 3617 | 0.005 |
| 3618 | 0.003 |
| 3619 | 0.003 |
| 3620 | 0.005 |
| 3621 | 0.004 |
| 3622 | 0.004 |
| 3623 | 0.004 |
| 3624 | 0.006 |
| 3625 | 0.003 |
| 3626 | 0.003 |
| 3627 | 0.005 |
| 3628 | 0.003 |
| 3629 | 0.002 |
| 3630 | 0.003 |
| 3631 | 0.005 |
| 3632 | 0.004 |
| 3633 | 0.003 |
| 3634 | 0.003 |
| 3635 | 0.003 |
| 3636 | 0.001 |
| 3637 | 0.003 |
| 3638 | 0.002 |
| 3639 | 0.002 |
| 3640 | 0.002 |
| 3641 | 0.001 |
| 3642 | 0.006 |
| 3643 | 0.003 |
| 3644 | 0.003 |
| 3645 | 0.002 |
| 3646 | 0.009 |
| 3647 | 0.005 |
| 3648 | 0.002 |
| 3649 | 0.007 |
| 3650 | 0.006 |
| 3651 | 0.008 |
| 3652 | 0.004 |
| 3653 | 0.002 |
| 3654 | 0.003 |
| 3655 | 0.003 |
| 3656 | 0.004 |
| 3657 | 0.003 |
| 3658 | 0.005 |
| 3659 | 0.005 |
| 3660 | 0.006 |
| 3661 | 0.009 |
| 3662 | 0.006 |
| 3663 | 0.003 |
| 3664 | 0.007 |
| 3665 | 0.004 |
| 3666 | 0.003 |
| 3667 | 0.004 |
| 3668 | 0.001 |
| 3669 | 0.008 |
| 3670 | 0.005 |
| 3671 | 0.005 |
| 3672 | 0.006 |
| 3673 | 0.009 |
| 3674 | 0.005 |
| 3675 | 0.005 |
| 3676 | 0.007 |
| 3677 | 0.005 |
| 3678 | 0.007 |
| 3679 | 0.006 |
| 3680 | 0.004 |
| 3681 | 0.002 |
| 3682 | 0.003 |
| 3683 | 0.003 |
| 3684 | 0.004 |
| 3685 | 0 |
| 3686 | 0.006 |
| 3687 | 0.002 |
| 3688 | 0.004 |
| 3689 | 0.004 |
| 3690 | 0.003 |
| 3691 | 0.004 |
| 3692 | 0.002 |
| 3693 | 0.004 |
| 3694 | 0.002 |
| 3695 | 0.004 |
| 3696 | 0.002 |
| 3697 | 0.004 |
| 3698 | 0.002 |
| 3699 | 0.002 |
| 3700 | 0.004 |
| 3701 | 0.002 |
| 3702 | 0.002 |
| 3703 | 0.003 |
| 3704 | 0.003 |
| 3705 | 0.001 |
| 3706 | 0.002 |
| 3707 | 0.004 |
| 3708 | 0.002 |
| 3709 | 0.002 |
| 3710 | 0.003 |
| 3711 | 0.003 |
| 3712 | 0.003 |
| 3713 | 0.005 |
| 3714 | 0.007 |
| 3715 | 0.009 |
| 3716 | 0.002 |
| 3717 | 0.007 |
| 3718 | 0.006 |
| 3719 | 0.007 |
| 3720 | 0.002 |
| 3721 | 0.008 |
| 3722 | 0.008 |
| 3723 | 0.002 |
| 3724 | 0.006 |
| 3725 | 0.004 |
| 3726 | 0.012 |
| 3727 | 0.003 |
| 3728 | 0.002 |
| 3729 | 0.005 |
| 3730 | 0.003 |
| 3731 | 0.002 |
| 3732 | 0.006 |
| 3733 | 0.003 |
| 3734 | 0.005 |
| 3735 | 0.005 |
| 3736 | 0.003 |
| 3737 | 0.004 |
| 3738 | 0.005 |
| 3739 | 0.004 |
| 3740 | 0.004 |
| 3741 | 0.009 |
| 3742 | 0.003 |
| 3743 | 0.005 |
| 3744 | 0.004 |
| 3745 | 0.004 |
| 3746 | 0.004 |
| 3747 | 0.005 |
| 3748 | 0.003 |
| 3749 | 0.002 |
| 3750 | 0.004 |
| 3751 | 0.003 |
| 3752 | 0.002 |
| 3753 | 0.004 |
| 3754 | 0.004 |
| 3755 | 0.003 |
| 3756 | 0.007 |
| 3757 | 0.006 |
| 3758 | 0.004 |
| 3759 | 0.003 |
| 3760 | 0.002 |
| 3761 | 0.001 |
| 3762 | 0.004 |
| 3763 | 0.003 |
| 3764 | 0.001 |
| 3765 | 0.002 |
| 3766 | 0.002 |
| 3767 | 0.009 |
| 3768 | 0.004 |
| 3769 | 0.003 |
| 3770 | 0.009 |
| 3771 | 0.006 |
| 3772 | 0.004 |
| 3773 | 0.004 |
| 3774 | 0.005 |
| 3775 | 0.004 |
| 3776 | 0.001 |
| 3777 | 0.002 |
| 3778 | 0.003 |
| 3779 | 0.01 |
| 3780 | 0.007 |
| 3781 | 0.001 |
| 3782 | 0.003 |
| 3783 | 0.002 |
| 3784 | 0.001 |
| 3785 | 0.001 |
| 3786 | 0.003 |
| 3787 | 0.002 |
| 3788 | 0.003 |
| 3789 | 0.002 |
| 3790 | 0.008 |
| 3791 | 0.003 |
| 3792 | 0.002 |
| 3793 | 0.003 |
| 3794 | 0.006 |
| 3795 | 0.005 |
| 3796 | 0.001 |
| 3797 | 0.004 |
| 3798 | 0.004 |
| 3799 | 0.002 |
| 3800 | 0.005 |
| 3801 | 0.005 |
| 3802 | 0.004 |
| 3803 | 0.01 |
| 3804 | 0.002 |
| 3805 | 0.008 |
| 3806 | 0.009 |
| 3807 | 0.007 |
| 3808 | 0.003 |
| 3809 | 0.002 |
| 3810 | 0.001 |
| 3811 | 0 |
| 3812 | 0.002 |
| 3813 | 0.002 |
| 3814 | 0.003 |
| 3815 | 0.004 |
| 3816 | 0.002 |
| 3817 | 0.004 |
| 3818 | 0.005 |
| 3819 | 0.003 |
| 3820 | 0.002 |
| 3821 | 0.004 |
| 3822 | 0.002 |
| 3823 | 0.009 |
| 3824 | 0.002 |
| 3825 | 0.001 |
| 3826 | 0.004 |
| 3827 | 0.006 |
| 3828 | 0.005 |
| 3829 | 0.004 |
| 3830 | 0.004 |
| 3831 | 0.002 |
| 3832 | 0.001 |
| 3833 | 0.002 |
| 3834 | 0.004 |
| 3835 | 0.002 |
| 3836 | 0.003 |
| 3837 | 0.001 |
| 3838 | 0.009 |
| 3839 | 0.007 |
| 3840 | 0.001 |
| 3841 | 0.005 |
| 3842 | 0.007 |
| 3843 | 0.007 |
| 3844 | 0.002 |
| 3845 | 0.003 |
| 3846 | 0.001 |
| 3847 | 0.006 |
| 3848 | 0.003 |
| 3849 | 0.006 |
| 3850 | 0.003 |
| 3851 | 0.006 |
| 3852 | 0.003 |
| 3853 | 0.004 |
| 3854 | 0.004 |
| 3855 | 0.005 |
| 3856 | 0.008 |
| 3857 | 0.005 |
| 3858 | 0.005 |
| 3859 | 0.006 |
| 3860 | 0.002 |
| 3861 | 0.003 |
| 3862 | 0.002 |
| 3863 | 0.002 |
| 3864 | 0.002 |
| 3865 | 0.004 |
| 3866 | 0.003 |
| 3867 | 0.004 |
| 3868 | 0.002 |
| 3869 | 0.003 |
| 3870 | 0.003 |
| 3871 | 0.014 |
| 3872 | 0.002 |
| 3873 | 0.004 |
| 3874 | 0.008 |
| 3875 | 0.002 |
| 3876 | 0.002 |
| 3877 | 0.004 |
| 3878 | 0.004 |
| 3879 | 0.004 |
| 3880 | 0.002 |
| 3881 | 0.002 |
| 3882 | 0.01 |
| 3883 | 0.006 |
| 3884 | 0.004 |
| 3885 | 0.004 |
| 3886 | 0.009 |
| 3887 | 0.013 |
| 3888 | 0.003 |
| 3889 | 0.005 |
| 3890 | 0.003 |
| 3891 | 0.005 |
| 3892 | 0.003 |
| 3893 | 0.001 |
| 3894 | 0.003 |
| 3895 | 0.007 |
| 3896 | 0.009 |
| 3897 | 0.005 |
| 3898 | 0.005 |
| 3899 | 0.006 |
| 3900 | 0.003 |
| 3901 | 0.003 |
| 3902 | 0.002 |
| 3903 | 0.004 |
| 3904 | 0.002 |
| 3905 | 0.003 |
| 3906 | 0.004 |
| 3907 | 0.009 |
| 3908 | 0.003 |
| 3909 | 0.004 |
| 3910 | 0.005 |
| 3911 | 0.005 |
| 3912 | 0.008 |
| 3913 | 0.003 |
| 3914 | 0.006 |
| 3915 | 0.001 |
| 3916 | 0.004 |
| 3917 | 0.001 |
| 3918 | 0.004 |
| 3919 | 0.003 |
| 3920 | 0.003 |
| 3921 | 0.003 |
| 3922 | 0.003 |
| 3923 | 0.004 |
| 3924 | 0.004 |
| 3925 | 0.004 |
| 3926 | 0.001 |
| 3927 | 0.004 |
| 3928 | 0.002 |
| 3929 | 0.006 |
| 3930 | 0.003 |
| 3931 | 0.002 |
| 3932 | 0.005 |
| 3933 | 0.002 |
| 3934 | 0.003 |
| 3935 | 0.007 |
| 3936 | 0.002 |
| 3937 | 0.001 |
| 3938 | 0.002 |
| 3939 | 0.002 |
| 3940 | 0.004 |
| 3941 | 0.001 |
| 3942 | 0.004 |
| 3943 | 0.002 |
| 3944 | 0.003 |
| 3945 | 0.005 |
| 3946 | 0.006 |
| 3947 | 0.004 |
| 3948 | 0.004 |
| 3949 | 0.007 |
| 3950 | 0.005 |
| 3951 | 0.005 |
| 3952 | 0.006 |
| 3953 | 0.004 |
| 3954 | 0.003 |
| 3955 | 0.009 |
| 3956 | 0.006 |
| 3957 | 0.01 |
| 3958 | 0.006 |
| 3959 | 0.003 |
| 3960 | 0.003 |
| 3961 | 0.004 |
| 3962 | 0.003 |
| 3963 | 0.003 |
| 3964 | 0.003 |
| 3965 | 0.005 |
| 3966 | 0.002 |
| 3967 | 0.005 |
| 3968 | 0.012 |
| 3969 | 0.011 |
| 3970 | 0.006 |
| 3971 | 0.009 |
| 3972 | 0.003 |
| 3973 | 0.007 |
| 3974 | 0.012 |
| 3975 | 0.005 |
| 3976 | 0.009 |
| 3977 | 0.004 |
| 3978 | 0.003 |
| 3979 | 0.008 |
| 3980 | 0.004 |
| 3981 | 0.004 |
| 3982 | 0.003 |
| 3983 | 0.007 |
| 3984 | 0.008 |
| 3985 | 0.01 |
| 3986 | 0.004 |
| 3987 | 0.003 |
| 3988 | 0.004 |
| 3989 | 0.001 |
| 3990 | 0.007 |
| 3991 | 0.002 |
| 3992 | 0.005 |
| 3993 | 0.004 |
| 3994 | 0.002 |
| 3995 | 0.004 |
| 3996 | 0.008 |
| 3997 | 0.002 |
| 3998 | 0.002 |
| 3999 | 0.003 |
| 4000 | 0.008 |
| 4001 | 0.003 |
| 4002 | 0.002 |
| 4003 | 0.006 |
| 4004 | 0.003 |
| 4005 | 0.001 |
| 4006 | 0.005 |
| 4007 | 0.005 |
| 4008 | 0.003 |
| 4009 | 0.005 |
| 4010 | 0.005 |
| 4011 | 0.004 |
| 4012 | 0.001 |
| 4013 | 0.002 |
| 4014 | 0.004 |
| 4015 | 0.005 |
| 4016 | 0.003 |
| 4017 | 0.004 |
| 4018 | 0.006 |
| 4019 | 0.004 |
| 4020 | 0.002 |
| 4021 | 0.006 |
| 4022 | 0.004 |
| 4023 | 0.002 |
| 4024 | 0.002 |
| 4025 | 0.005 |
| 4026 | 0.01 |
| 4027 | 0.008 |
| 4028 | 0.002 |
| 4029 | 0.003 |
| 4030 | 0.003 |
| 4031 | 0.005 |
| 4032 | 0.002 |
| 4033 | 0.002 |
| 4034 | 0.004 |
| 4035 | 0.008 |
| 4036 | 0.002 |
| 4037 | 0.002 |
| 4038 | 0.007 |
| 4039 | 0.009 |
| 4040 | 0.003 |
| 4041 | 0.002 |
| 4042 | 0.003 |
| 4043 | 0.004 |
| 4044 | 0.007 |
| 4045 | 0.002 |
| 4046 | 0.003 |
| 4047 | 0.003 |
| 4048 | 0.005 |
| 4049 | 0.01 |
| 4050 | 0.003 |
| 4051 | 0.006 |
| 4052 | 0.01 |
| 4053 | 0.003 |
| 4054 | 0.002 |
| 4055 | 0.007 |
| 4056 | 0.004 |
| 4057 | 0.002 |
| 4058 | 0.003 |
| 4059 | 0.003 |
| 4060 | 0.007 |
| 4061 | 0.003 |
| 4062 | 0.005 |
| 4063 | 0.002 |
| 4064 | 0.002 |
| 4065 | 0.003 |
| 4066 | 0.006 |
| 4067 | 0.002 |
| 4068 | 0.004 |
| 4069 | 0.005 |
| 4070 | 0.008 |
| 4071 | 0.005 |
| 4072 | 0.005 |
| 4073 | 0.004 |
| 4074 | 0.001 |
| 4075 | 0.004 |
| 4076 | 0.003 |
| 4077 | 0.006 |
| 4078 | 0.007 |
| 4079 | 0.006 |
| 4080 | 0.002 |
| 4081 | 0.003 |
| 4082 | 0.008 |
| 4083 | 0.01 |
| 4084 | 0.002 |
| 4085 | 0.002 |
| 4086 | 0.003 |
| 4087 | 0.004 |
| 4088 | 0.003 |
| 4089 | 0.004 |
| 4090 | 0.009 |
| 4091 | 0.006 |
| 4092 | 0.003 |
| 4093 | 0.005 |
| 4094 | 0.003 |
| 4095 | 0.003 |
| 4096 | 0.003 |
| 4097 | 0.003 |
| 4098 | 0.006 |
| 4099 | 0.007 |
| 4100 | 0.005 |
| 4101 | 0.002 |
| 4102 | 0.005 |
| 4103 | 0.006 |
| 4104 | 0.002 |
| 4105 | 0.004 |
| 4106 | 0.003 |
| 4107 | 0.006 |
| 4108 | 0.003 |
| 4109 | 0.001 |
| 4110 | 0.005 |
| 4111 | 0.003 |
| 4112 | 0.002 |
| 4113 | 0.001 |
| 4114 | 0.002 |
| 4115 | 0.006 |
| 4116 | 0.001 |
| 4117 | 0.004 |
| 4118 | 0.007 |
| 4119 | 0.008 |
| 4120 | 0.004 |
| 4121 | 0.006 |
| 4122 | 0.009 |
| 4123 | 0.008 |
| 4124 | 0.001 |
| 4125 | 0.004 |
| 4126 | 0.006 |
| 4127 | 0.005 |
| 4128 | 0.002 |
| 4129 | 0.003 |
| 4130 | 0.005 |
| 4131 | 0.004 |
| 4132 | 0.002 |
| 4133 | 0.001 |
| 4134 | 0.008 |
| 4135 | 0.012 |
| 4136 | 0 |
| 4137 | 0.002 |
| 4138 | 0.004 |
| 4139 | 0.003 |
| 4140 | 0.006 |
| 4141 | 0.005 |
| 4142 | 0.002 |
| 4143 | 0.007 |
| 4144 | 0.003 |
| 4145 | 0.005 |
| 4146 | 0.003 |
| 4147 | 0.003 |
| 4148 | 0.01 |
| 4149 | 0.001 |
| 4150 | 0.005 |
| 4151 | 0.005 |
| 4152 | 0.01 |
| 4153 | 0.001 |
| 4154 | 0.003 |
| 4155 | 0.008 |
| 4156 | 0.001 |
| 4157 | 0.001 |
| 4158 | 0.005 |
| 4159 | 0.008 |
| 4160 | 0.004 |
| 4161 | 0.006 |
| 4162 | 0.003 |
| 4163 | 0.004 |
| 4164 | 0.003 |
| 4165 | 0.003 |
| 4166 | 0.007 |
| 4167 | 0.005 |
| 4168 | 0.003 |
| 4169 | 0.005 |
| 4170 | 0.007 |
| 4171 | 0.003 |
| 4172 | 0.004 |
| 4173 | 0.002 |
| 4174 | 0.002 |
| 4175 | 0.005 |
| 4176 | 0.003 |
| 4177 | 0.003 |
| 4178 | 0.005 |
| 4179 | 0.009 |
| 4180 | 0.004 |
| 4181 | 0.004 |
| 4182 | 0.003 |
| 4183 | 0.004 |
| 4184 | 0.004 |
| 4185 | 0.001 |
| 4186 | 0.005 |
| 4187 | 0.003 |
| 4188 | 0.004 |
| 4189 | 0.001 |
| 4190 | 0.001 |
| 4191 | 0.004 |
| 4192 | 0.001 |
| 4193 | 0.003 |
| 4194 | 0.003 |
| 4195 | 0.003 |
| 4196 | 0.006 |
| 4197 | 0.005 |
| 4198 | 0.005 |
| 4199 | 0.006 |
| 4200 | 0.007 |
| 4201 | 0.003 |
| 4202 | 0.002 |
| 4203 | 0.003 |
| 4204 | 0.002 |
| 4205 | 0.002 |
| 4206 | 0.004 |
| 4207 | 0.005 |
| 4208 | 0.003 |
| 4209 | 0.005 |
| 4210 | 0.002 |
| 4211 | 0.004 |
| 4212 | 0.003 |
| 4213 | 0.002 |
| 4214 | 0.002 |
| 4215 | 0.006 |
| 4216 | 0.008 |
| 4217 | 0.008 |
| 4218 | 0.001 |
| 4219 | 0.003 |
| 4220 | 0.001 |
| 4221 | 0.003 |
| 4222 | 0.005 |
| 4223 | 0.005 |
| 4224 | 0.002 |
| 4225 | 0.003 |
| 4226 | 0.005 |
| 4227 | 0.004 |
| 4228 | 0.004 |
| 4229 | 0.007 |
| 4230 | 0.007 |
| 4231 | 0.003 |
| 4232 | 0.005 |
| 4233 | 0.004 |
| 4234 | 0.003 |
| 4235 | 0.005 |
| 4236 | 0.002 |
| 4237 | 0.001 |
| 4238 | 0.002 |
| 4239 | 0.002 |
| 4240 | 0.007 |
| 4241 | 0.003 |
| 4242 | 0.004 |
| 4243 | 0.003 |
| 4244 | 0.003 |
| 4245 | 0.003 |
| 4246 | 0.006 |
| 4247 | 0.003 |
| 4248 | 0.009 |
| 4249 | 0.006 |
| 4250 | 0.005 |
| 4251 | 0.006 |
| 4252 | 0.007 |
| 4253 | 0.006 |
| 4254 | 0.006 |
| 4255 | 0.003 |
| 4256 | 0.003 |
| 4257 | 0.004 |
| 4258 | 0.006 |
| 4259 | 0.007 |
| 4260 | 0.008 |
| 4261 | 0.005 |
| 4262 | 0.003 |
| 4263 | 0.007 |
| 4264 | 0.003 |
| 4265 | 0.007 |
| 4266 | 0.007 |
| 4267 | 0.003 |
| 4268 | 0.003 |
| 4269 | 0.007 |
| 4270 | 0.006 |
| 4271 | 0.009 |
| 4272 | 0.004 |
| 4273 | 0.002 |
| 4274 | 0.006 |
| 4275 | 0.005 |
| 4276 | 0.004 |
| 4277 | 0.005 |
| 4278 | 0.007 |
| 4279 | 0.006 |
| 4280 | 0.002 |
| 4281 | 0.001 |
| 4282 | 0.003 |
| 4283 | 0.009 |
| 4284 | 0.005 |
| 4285 | 0.004 |
| 4286 | 0.004 |
| 4287 | 0.003 |
| 4288 | 0.004 |
| 4289 | 0.005 |
| 4290 | 0.007 |
| 4291 | 0.006 |
| 4292 | 0.006 |
| 4293 | 0.005 |
| 4294 | 0.006 |
| 4295 | 0.008 |
| 4296 | 0.002 |
| 4297 | 0.004 |
| 4298 | 0.001 |
| 4299 | 0.003 |
| 4300 | 0.003 |
| 4301 | 0.003 |
| 4302 | 0.008 |
| 4303 | 0.002 |
| 4304 | 0.003 |
| 4305 | 0.001 |
| 4306 | 0.002 |
| 4307 | 0.002 |
| 4308 | 0.004 |
| 4309 | 0.004 |
| 4310 | 0.002 |
| 4311 | 0.002 |
| 4312 | 0.002 |
| 4313 | 0.004 |
| 4314 | 0.005 |
| 4315 | 0.003 |
| 4316 | 0.002 |
| 4317 | 0.003 |
| 4318 | 0.006 |
| 4319 | 0.007 |
| 4320 | 0.003 |
| 4321 | 0.006 |
| 4322 | 0.003 |
| 4323 | 0.004 |
| 4324 | 0.002 |
| 4325 | 0.003 |
| 4326 | 0.005 |
| 4327 | 0.009 |
| 4328 | 0.002 |
| 4329 | 0.003 |
| 4330 | 0.004 |
| 4331 | 0.003 |
| 4332 | 0 |
| 4333 | 0.002 |
| 4334 | 0.002 |
| 4335 | 0.004 |
| 4336 | 0.003 |
| 4337 | 0.003 |
| 4338 | 0.003 |
| 4339 | 0.003 |
| 4340 | 0.003 |
| 4341 | 0.003 |
| 4342 | 0.006 |
| 4343 | 0.002 |
| 4344 | 0.006 |
| 4345 | 0.005 |
| 4346 | 0.002 |
| 4347 | 0.003 |
| 4348 | 0.001 |
| 4349 | 0.001 |
| 4350 | 0.003 |
| 4351 | 0.002 |
| 4352 | 0.003 |
| 4353 | 0.006 |
| 4354 | 0.006 |
| 4355 | 0.005 |
| 4356 | 0.003 |
| 4357 | 0.002 |
| 4358 | 0.003 |
| 4359 | 0.007 |
| 4360 | 0.005 |
| 4361 | 0.003 |
| 4362 | 0.007 |
| 4363 | 0.006 |
| 4364 | 0.002 |
| 4365 | 0.007 |
| 4366 | 0.008 |
| 4367 | 0.011 |
| 4368 | 0.002 |
| 4369 | 0.005 |
| 4370 | 0.006 |
| 4371 | 0.004 |
| 4372 | 0.006 |
| 4373 | 0.006 |
| 4374 | 0.003 |
| 4375 | 0.007 |
| 4376 | 0.002 |
| 4377 | 0.005 |
| 4378 | 0.011 |
| 4379 | 0.002 |
| 4380 | 0.002 |
| 4381 | 0.002 |
| 4382 | 0.007 |
| 4383 | 0.005 |
| 4384 | 0.002 |
| 4385 | 0.003 |
| 4386 | 0.005 |
| 4387 | 0.008 |
| 4388 | 0.005 |
| 4389 | 0.002 |
| 4390 | 0.008 |
| 4391 | 0.002 |
| 4392 | 0.004 |
| 4393 | 0.003 |
| 4394 | 0.003 |
| 4395 | 0.002 |
| 4396 | 0.003 |
| 4397 | 0.003 |
| 4398 | 0.004 |
| 4399 | 0.009 |
| 4400 | 0.007 |
| 4401 | 0.003 |
| 4402 | 0.004 |
| 4403 | 0.007 |
| 4404 | 0.002 |
| 4405 | 0.004 |
| 4406 | 0.006 |
| 4407 | 0.006 |
| 4408 | 0.002 |
| 4409 | 0.004 |
| 4410 | 0.013 |
| 4411 | 0.003 |
| 4412 | 0.001 |
| 4413 | 0.003 |
| 4414 | 0.007 |
| 4415 | 0.002 |
| 4416 | 0.002 |
| 4417 | 0.003 |
| 4418 | 0.006 |
| 4419 | 0.003 |
| 4420 | 0.004 |
| 4421 | 0.004 |
| 4422 | 0.003 |
| 4423 | 0.003 |
| 4424 | 0.003 |
| 4425 | 0.005 |
| 4426 | 0.005 |
| 4427 | 0.001 |
| 4428 | 0.003 |
| 4429 | 0.009 |
| 4430 | 0.004 |
| 4431 | 0.008 |
| 4432 | 0.004 |
| 4433 | 0.002 |
| 4434 | 0.003 |
| 4435 | 0.003 |
| 4436 | 0.003 |
| 4437 | 0.004 |
| 4438 | 0.002 |
| 4439 | 0.004 |
| 4440 | 0.003 |
| 4441 | 0.002 |
| 4442 | 0.003 |
| 4443 | 0.003 |
| 4444 | 0.002 |
| 4445 | 0.003 |
| 4446 | 0.003 |
| 4447 | 0.002 |
| 4448 | 0.003 |
| 4449 | 0.003 |
| 4450 | 0.002 |
| 4451 | 0.004 |
| 4452 | 0.002 |
| 4453 | 0.002 |
| 4454 | 0.003 |
| 4455 | 0.003 |
| 4456 | 0.003 |
| 4457 | 0.004 |
| 4458 | 0.004 |
| 4459 | 0.011 |
| 4460 | 0.007 |
| 4461 | 0.009 |
| 4462 | 0.008 |
| 4463 | 0.007 |
| 4464 | 0.005 |
| 4465 | 0.006 |
| 4466 | 0.001 |
| 4467 | 0.005 |
| 4468 | 0.002 |
| 4469 | 0.006 |
| 4470 | 0.004 |
| 4471 | 0.004 |
| 4472 | 0.002 |
| 4473 | 0.003 |
| 4474 | 0.005 |
| 4475 | 0.007 |
| 4476 | 0.003 |
| 4477 | 0.006 |
| 4478 | 0.005 |
| 4479 | 0.002 |
| 4480 | 0.001 |
| 4481 | 0.003 |
| 4482 | 0.005 |
| 4483 | 0.004 |
| 4484 | 0.002 |
| 4485 | 0.001 |
| 4486 | 0.003 |
| 4487 | 0.006 |
| 4488 | 0.005 |
| 4489 | 0.001 |
| 4490 | 0.001 |
| 4491 | 0.006 |
| 4492 | 0.005 |
| 4493 | 0.005 |
| 4494 | 0.004 |
| 4495 | 0.007 |
| 4496 | 0.008 |
| 4497 | 0.002 |
| 4498 | 0.001 |
| 4499 | 0.003 |
| 4500 | 0.002 |
| 4501 | 0.005 |
| 4502 | 0.004 |
| 4503 | 0.003 |
| 4504 | 0.004 |
| 4505 | 0.001 |
| 4506 | 0.007 |
| 4507 | 0.004 |
| 4508 | 0.008 |
| 4509 | 0.003 |
| 4510 | 0.002 |
| 4511 | 0.001 |
| 4512 | 0.005 |
| 4513 | 0.002 |
| 4514 | 0.004 |
| 4515 | 0.009 |
| 4516 | 0.009 |
| 4517 | 0.007 |
| 4518 | 0.002 |
| 4519 | 0.004 |
| 4520 | 0.007 |
| 4521 | 0.003 |
| 4522 | 0.003 |
| 4523 | 0.007 |
| 4524 | 0.003 |
| 4525 | 0.003 |
| 4526 | 0.002 |
| 4527 | 0.005 |
| 4528 | 0.003 |
| 4529 | 0.01 |
| 4530 | 0.008 |
| 4531 | 0.009 |
| 4532 | 0.009 |
| 4533 | 0.004 |
| 4534 | 0.003 |
| 4535 | 0.006 |
| 4536 | 0.005 |
| 4537 | 0.003 |
| 4538 | 0.006 |
| 4539 | 0.004 |
| 4540 | 0.001 |
| 4541 | 0.003 |
| 4542 | 0.003 |
| 4543 | 0.004 |
| 4544 | 0.002 |
| 4545 | 0.003 |
| 4546 | 0.008 |
| 4547 | 0.001 |
| 4548 | 0.005 |
| 4549 | 0.001 |
| 4550 | 0.001 |
| 4551 | 0.005 |
| 4552 | 0.001 |
| 4553 | 0.008 |
| 4554 | 0.008 |
| 4555 | 0.006 |
| 4556 | 0.008 |
| 4557 | 0.008 |
| 4558 | 0.004 |
| 4559 | 0.001 |
| 4560 | 0.002 |
| 4561 | 0.007 |
| 4562 | 0.005 |
| 4563 | 0.003 |
| 4564 | 0.004 |
| 4565 | 0.004 |
| 4566 | 0.006 |
| 4567 | 0.006 |
| 4568 | 0.005 |
| 4569 | 0.007 |
| 4570 | 0.001 |
| 4571 | 0.004 |
| 4572 | 0.006 |
| 4573 | 0.006 |
| 4574 | 0.005 |
| 4575 | 0.001 |
| 4576 | 0.003 |
| 4577 | 0.003 |
| 4578 | 0.007 |
| 4579 | 0.006 |
| 4580 | 0.001 |
| 4581 | 0.004 |
| 4582 | 0.01 |
| 4583 | 0.006 |
| 4584 | 0.005 |
| 4585 | 0.006 |
| 4586 | 0.006 |
| 4587 | 0.005 |
| 4588 | 0.003 |
| 4589 | 0.002 |
| 4590 | 0.004 |
| 4591 | 0.004 |
| 4592 | 0.001 |
| 4593 | 0.002 |
| 4594 | 0.008 |
| 4595 | 0.005 |
| 4596 | 0.002 |
| 4597 | 0.002 |
| 4598 | 0.006 |
| 4599 | 0.004 |
| 4600 | 0.003 |
| 4601 | 0.002 |
| 4602 | 0.008 |
| 4603 | 0.001 |
| 4604 | 0.001 |
| 4605 | 0.003 |
| 4606 | 0.005 |
| 4607 | 0.007 |
| 4608 | 0.002 |
| 4609 | 0.003 |
| 4610 | 0.003 |
| 4611 | 0.006 |
| 4612 | 0.004 |
| 4613 | 0.001 |
| 4614 | 0.004 |
| 4615 | 0.004 |
| 4616 | 0.001 |
| 4617 | 0.003 |
| 4618 | 0.004 |
| 4619 | 0.004 |
| 4620 | 0.003 |
| 4621 | 0.005 |
| 4622 | 0.005 |
| 4623 | 0.004 |
| 4624 | 0.002 |
| 4625 | 0.004 |
| 4626 | 0.004 |
| 4627 | 0.008 |
| 4628 | 0.002 |
| 4629 | 0.004 |
| 4630 | 0.006 |
| 4631 | 0.007 |
| 4632 | 0.003 |
| 4633 | 0.002 |
| 4634 | 0.003 |
| 4635 | 0.005 |
| 4636 | 0.003 |
| 4637 | 0.003 |
| 4638 | 0.005 |
| 4639 | 0.005 |
| 4640 | 0.007 |
| 4641 | 0.005 |
| 4642 | 0.007 |
| 4643 | 0.004 |
| 4644 | 0.003 |
| 4645 | 0.003 |
| 4646 | 0.004 |
| 4647 | 0.007 |
| 4648 | 0.003 |
| 4649 | 0.002 |
| 4650 | 0.01 |
| 4651 | 0.007 |
| 4652 | 0.002 |
| 4653 | 0.001 |
| 4654 | 0.005 |
| 4655 | 0.009 |
| 4656 | 0.004 |
| 4657 | 0.007 |
| 4658 | 0.003 |
| 4659 | 0.004 |
| 4660 | 0.008 |
| 4661 | 0.001 |
| 4662 | 0.002 |
| 4663 | 0.002 |
| 4664 | 0.005 |
| 4665 | 0.002 |
| 4666 | 0.003 |
| 4667 | 0.007 |
| 4668 | 0.007 |
| 4669 | 0.003 |
| 4670 | 0.001 |
| 4671 | 0.007 |
| 4672 | 0.009 |
| 4673 | 0.002 |
| 4674 | 0.006 |
| 4675 | 0.007 |
| 4676 | 0.005 |
| 4677 | 0.004 |
| 4678 | 0.003 |
| 4679 | 0.006 |
| 4680 | 0.013 |
| 4681 | 0.003 |
| 4682 | 0.008 |
| 4683 | 0.005 |
| 4684 | 0.002 |
| 4685 | 0.004 |
| 4686 | 0.006 |
| 4687 | 0.006 |
| 4688 | 0.006 |
| 4689 | 0.002 |
| 4690 | 0.003 |
| 4691 | 0.003 |
| 4692 | 0.006 |
| 4693 | 0.004 |
| 4694 | 0.005 |
| 4695 | 0.005 |
| 4696 | 0.003 |
| 4697 | 0.002 |
| 4698 | 0.002 |
| 4699 | 0.007 |
| 4700 | 0.001 |
| 4701 | 0.004 |
| 4702 | 0.008 |
| 4703 | 0.005 |
| 4704 | 0.001 |
| 4705 | 0.002 |
| 4706 | 0.004 |
| 4707 | 0.011 |
| 4708 | 0.004 |
| 4709 | 0.004 |
| 4710 | 0.005 |
| 4711 | 0.004 |
| 4712 | 0.002 |
| 4713 | 0.005 |
| 4714 | 0.003 |
| 4715 | 0.002 |
| 4716 | 0.003 |
| 4717 | 0.006 |
| 4718 | 0.009 |
| 4719 | 0.006 |
| 4720 | 0.001 |
| 4721 | 0.001 |
| 4722 | 0.004 |
| 4723 | 0.003 |
| 4724 | 0.002 |
| 4725 | 0.002 |
| 4726 | 0.004 |
| 4727 | 0.012 |
| 4728 | 0.004 |
| 4729 | 0.002 |
| 4730 | 0.01 |
| 4731 | 0.006 |
| 4732 | 0.005 |
| 4733 | 0.004 |
| 4734 | 0.01 |
| 4735 | 0.009 |
| 4736 | 0.005 |
| 4737 | 0.004 |
| 4738 | 0.006 |
| 4739 | 0.008 |
| 4740 | 0.002 |
| 4741 | 0.003 |
| 4742 | 0.008 |
| 4743 | 0.003 |
| 4744 | 0.002 |
| 4745 | 0.001 |
| 4746 | 0.003 |
| 4747 | 0.003 |
| 4748 | 0.001 |
| 4749 | 0.002 |
| 4750 | 0.006 |
| 4751 | 0.01 |
| 4752 | 0.006 |
| 4753 | 0.002 |
| 4754 | 0.004 |
| 4755 | 0.004 |
| 4756 | 0.002 |
| 4757 | 0.002 |
| 4758 | 0.003 |
| 4759 | 0.006 |
| 4760 | 0.004 |
| 4761 | 0.001 |
| 4762 | 0.002 |
| 4763 | 0.003 |
| 4764 | 0.003 |
| 4765 | 0.001 |
| 4766 | 0.002 |
| 4767 | 0.003 |
| 4768 | 0.002 |
| 4769 | 0.001 |
| 4770 | 0.005 |
| 4771 | 0.003 |
| 4772 | 0.007 |
| 4773 | 0.001 |
| 4774 | 0.005 |
| 4775 | 0.003 |
| 4776 | 0.005 |
| 4777 | 0.002 |
| 4778 | 0.003 |
| 4779 | 0.004 |
| 4780 | 0.007 |
| 4781 | 0.003 |
| 4782 | 0.006 |
| 4783 | 0.004 |
| 4784 | 0.004 |
| 4785 | 0.006 |
| 4786 | 0.002 |
| 4787 | 0.006 |
| 4788 | 0.008 |
| 4789 | 0.002 |
| 4790 | 0.002 |
| 4791 | 0.006 |
| 4792 | 0.008 |
| 4793 | 0.003 |
| 4794 | 0.004 |
| 4795 | 0.004 |
| 4796 | 0.009 |
| 4797 | 0.001 |
| 4798 | 0.002 |
| 4799 | 0.003 |
| 4800 | 0.005 |
| 4801 | 0.004 |
| 4802 | 0.006 |
| 4803 | 0.002 |
| 4804 | 0.004 |
| 4805 | 0.004 |
| 4806 | 0.001 |
| 4807 | 0.002 |
| 4808 | 0.005 |
| 4809 | 0.002 |
| 4810 | 0.005 |
| 4811 | 0.007 |
| 4812 | 0.003 |
| 4813 | 0.003 |
| 4814 | 0.001 |
| 4815 | 0.002 |
| 4816 | 0.002 |
| 4817 | 0.001 |
| 4818 | 0.003 |
| 4819 | 0.004 |
| 4820 | 0.006 |
| 4821 | 0.003 |
| 4822 | 0.009 |
| 4823 | 0.002 |
| 4824 | 0.002 |
| 4825 | 0.005 |
| 4826 | 0.007 |
| 4827 | 0.005 |
| 4828 | 0.005 |
| 4829 | 0.003 |
| 4830 | 0.006 |
| 4831 | 0.003 |
| 4832 | 0.001 |
| 4833 | 0.009 |
| 4834 | 0.003 |
| 4835 | 0.006 |
| 4836 | 0.005 |
| 4837 | 0.004 |
| 4838 | 0.003 |
| 4839 | 0.003 |
| 4840 | 0.003 |
| 4841 | 0.008 |
| 4842 | 0.007 |
| 4843 | 0.003 |
| 4844 | 0.004 |
| 4845 | 0.002 |
| 4846 | 0.006 |
| 4847 | 0.004 |
| 4848 | 0.003 |
| 4849 | 0.002 |
| 4850 | 0.008 |
| 4851 | 0.003 |
| 4852 | 0.001 |
| 4853 | 0.003 |
| 4854 | 0.003 |
| 4855 | 0.001 |
| 4856 | 0.005 |
| 4857 | 0.008 |
| 4858 | 0.003 |
| 4859 | 0.002 |
| 4860 | 0.011 |
| 4861 | 0.005 |
| 4862 | 0.004 |
| 4863 | 0.004 |
| 4864 | 0.005 |
| 4865 | 0.002 |
| 4866 | 0.002 |
| 4867 | 0.014 |
| 4868 | 0.01 |
| 4869 | 0.004 |
| 4870 | 0.002 |
| 4871 | 0.003 |
| 4872 | 0.004 |
| 4873 | 0.003 |
| 4874 | 0.003 |
| 4875 | 0.004 |
| 4876 | 0.006 |
| 4877 | 0.005 |
| 4878 | 0.004 |
| 4879 | 0.004 |
| 4880 | 0.004 |
| 4881 | 0.004 |
| 4882 | 0.006 |
| 4883 | 0.003 |
| 4884 | 0.002 |
| 4885 | 0.005 |
| 4886 | 0.009 |
| 4887 | 0.005 |
| 4888 | 0.001 |
| 4889 | 0.004 |
| 4890 | 0.008 |
| 4891 | 0.008 |
| 4892 | 0.004 |
| 4893 | 0.002 |
| 4894 | 0.006 |
| 4895 | 0.004 |
| 4896 | 0.003 |
| 4897 | 0.002 |
| 4898 | 0.004 |
| 4899 | 0.006 |
| 4900 | 0.003 |
| 4901 | 0.002 |
| 4902 | 0.006 |
| 4903 | 0.006 |
| 4904 | 0.004 |
| 4905 | 0.006 |
| 4906 | 0.007 |
| 4907 | 0.002 |
| 4908 | 0.002 |
| 4909 | 0.003 |
| 4910 | 0.004 |
| 4911 | 0.004 |
| 4912 | 0.005 |
| 4913 | 0.002 |
| 4914 | 0.003 |
| 4915 | 0.009 |
| 4916 | 0.005 |
| 4917 | 0.002 |
| 4918 | 0.002 |
| 4919 | 0.007 |
| 4920 | 0.005 |
| 4921 | 0.001 |
| 4922 | 0.004 |
| 4923 | 0.004 |
| 4924 | 0.004 |
| 4925 | 0.007 |
| 4926 | 0.007 |
| 4927 | 0.003 |
| 4928 | 0.008 |
| 4929 | 0.002 |
| 4930 | 0.003 |
| 4931 | 0.007 |
| 4932 | 0.003 |
| 4933 | 0.001 |
| 4934 | 0.003 |
| 4935 | 0.002 |
| 4936 | 0.005 |
| 4937 | 0.002 |
| 4938 | 0.005 |
| 4939 | 0.011 |
| 4940 | 0.011 |
| 4941 | 0.002 |
| 4942 | 0.005 |
| 4943 | 0.005 |
| 4944 | 0.005 |
| 4945 | 0.003 |
| 4946 | 0.006 |
| 4947 | 0.004 |
| 4948 | 0.004 |
| 4949 | 0.003 |
| 4950 | 0.002 |
| 4951 | 0.003 |
| 4952 | 0.003 |
| 4953 | 0.003 |
| 4954 | 0.006 |
| 4955 | 0.006 |
| 4956 | 0.002 |
| 4957 | 0.004 |
| 4958 | 0.005 |
| 4959 | 0.005 |
| 4960 | 0.003 |
| 4961 | 0.006 |
| 4962 | 0.002 |
| 4963 | 0.004 |
| 4964 | 0.004 |
| 4965 | 0.005 |
| 4966 | 0.002 |
| 4967 | 0.003 |
| 4968 | 0.001 |
| 4969 | 0.003 |
| 4970 | 0.002 |
| 4971 | 0.002 |
| 4972 | 0.003 |
| 4973 | 0.003 |
| 4974 | 0.003 |
| 4975 | 0.005 |
| 4976 | 0.003 |
| 4977 | 0.002 |
| 4978 | 0.007 |
| 4979 | 0.005 |
| 4980 | 0.007 |
| 4981 | 0.002 |
| 4982 | 0.005 |
| 4983 | 0.011 |
| 4984 | 0.006 |
| 4985 | 0.004 |
| 4986 | 0.003 |
| 4987 | 0.005 |
| 4988 | 0.004 |
| 4989 | 0.003 |
| 4990 | 0.002 |
| 4991 | 0.009 |
| 4992 | 0.003 |
| 4993 | 0.003 |
| 4994 | 0.003 |
| 4995 | 0.005 |
| 4996 | 0.002 |
| 4997 | 0.002 |
| 4998 | 0.006 |
| 4999 | 0.003 |
| 5000 | 0.005 |
| 5001 | 0.004 |
| 5002 | 0.002 |
| 5003 | 0.002 |
| 5004 | 0.002 |
| 5005 | 0.002 |
| 5006 | 0.003 |
| 5007 | 0.005 |
| 5008 | 0.002 |
| 5009 | 0.002 |
| 5010 | 0.004 |
| 5011 | 0.006 |
| 5012 | 0.003 |
| 5013 | 0.003 |
| 5014 | 0.005 |
| 5015 | 0.003 |
| 5016 | 0.004 |
| 5017 | 0.002 |
| 5018 | 0.004 |
| 5019 | 0.01 |
| 5020 | 0.003 |
| 5021 | 0.002 |
| 5022 | 0.006 |
| 5023 | 0.005 |
| 5024 | 0.002 |
| 5025 | 0.002 |
| 5026 | 0.009 |
| 5027 | 0.003 |
| 5028 | 0.002 |
| 5029 | 0.003 |
| 5030 | 0.004 |
| 5031 | 0.008 |
| 5032 | 0.004 |
| 5033 | 0.006 |
| 5034 | 0.004 |
| 5035 | 0.003 |
| 5036 | 0.004 |
| 5037 | 0.007 |
| 5038 | 0.004 |
| 5039 | 0.005 |
| 5040 | 0.002 |
| 5041 | 0.002 |
| 5042 | 0.003 |
| 5043 | 0.004 |
| 5044 | 0.001 |
| 5045 | 0.004 |
| 5046 | 0.002 |
| 5047 | 0.002 |
| 5048 | 0.001 |
| 5049 | 0.004 |
| 5050 | 0.008 |
| 5051 | 0.004 |
| 5052 | 0.001 |
| 5053 | 0.005 |
| 5054 | 0.005 |
| 5055 | 0.008 |
| 5056 | 0.001 |
| 5057 | 0.004 |
| 5058 | 0.004 |
| 5059 | 0.005 |
| 5060 | 0.004 |
| 5061 | 0.003 |
| 5062 | 0.004 |
| 5063 | 0.008 |
| 5064 | 0.009 |
| 5065 | 0.005 |
| 5066 | 0.003 |
| 5067 | 0.005 |
| 5068 | 0.016 |
| 5069 | 0.001 |
| 5070 | 0.002 |
| 5071 | 0.009 |
| 5072 | 0.004 |
| 5073 | 0.003 |
| 5074 | 0.006 |
| 5075 | 0.01 |
| 5076 | 0.009 |
| 5077 | 0.003 |
| 5078 | 0.003 |
| 5079 | 0.007 |
| 5080 | 0.008 |
| 5081 | 0.002 |
| 5082 | 0.004 |
| 5083 | 0.002 |
| 5084 | 0.002 |
| 5085 | 0.003 |
| 5086 | 0.004 |
| 5087 | 0.005 |
| 5088 | 0.002 |
| 5089 | 0.003 |
| 5090 | 0.008 |
| 5091 | 0.01 |
| 5092 | 0.004 |
| 5093 | 0.002 |
| 5094 | 0.01 |
| 5095 | 0.007 |
| 5096 | 0.002 |
| 5097 | 0.004 |
| 5098 | 0.008 |
| 5099 | 0.012 |
| 5100 | 0.001 |
| 5101 | 0.004 |
| 5102 | 0.006 |
| 5103 | 0.005 |
| 5104 | 0.003 |
| 5105 | 0.005 |
| 5106 | 0.008 |
| 5107 | 0.006 |
| 5108 | 0.002 |
| 5109 | 0.003 |
| 5110 | 0.003 |
| 5111 | 0.003 |
| 5112 | 0.002 |
| 5113 | 0.01 |
| 5114 | 0.003 |
| 5115 | 0.006 |
| 5116 | 0.011 |
| 5117 | 0.006 |
| 5118 | 0.002 |
| 5119 | 0.005 |
| 5120 | 0.005 |
| 5121 | 0.007 |
| 5122 | 0.008 |
| 5123 | 0.008 |
| 5124 | 0.003 |
| 5125 | 0.002 |
| 5126 | 0.004 |
| 5127 | 0.005 |
| 5128 | 0.002 |
| 5129 | 0.006 |
| 5130 | 0.004 |
| 5131 | 0.008 |
| 5132 | 0.005 |
| 5133 | 0.007 |
| 5134 | 0.005 |
| 5135 | 0.011 |
| 5136 | 0.002 |
| 5137 | 0.004 |
| 5138 | 0.007 |
| 5139 | 0.003 |
| 5140 | 0.004 |
| 5141 | 0.003 |
| 5142 | 0.008 |
| 5143 | 0.006 |
| 5144 | 0.001 |
| 5145 | 0.005 |
| 5146 | 0.003 |
| 5147 | 0.007 |
| 5148 | 0.002 |
| 5149 | 0.003 |
| 5150 | 0.006 |
| 5151 | 0.006 |
| 5152 | 0.003 |
| 5153 | 0.003 |
| 5154 | 0.003 |
| 5155 | 0.007 |
| 5156 | 0.006 |
| 5157 | 0.003 |
| 5158 | 0.001 |
| 5159 | 0.004 |
| 5160 | 0.003 |
| 5161 | 0.004 |
| 5162 | 0.002 |
| 5163 | 0.003 |
| 5164 | 0.008 |
| 5165 | 0.002 |
| 5166 | 0.003 |
| 5167 | 0.002 |
| 5168 | 0.006 |
| 5169 | 0 |
| 5170 | 0.002 |
| 5171 | 0.005 |
| 5172 | 0.003 |
| 5173 | 0.004 |
| 5174 | 0.002 |
| 5175 | 0.001 |
| 5176 | 0.001 |
| 5177 | 0.006 |
| 5178 | 0.004 |
| 5179 | 0.002 |
| 5180 | 0.004 |
| 5181 | 0.008 |
| 5182 | 0.009 |
| 5183 | 0.009 |
| 5184 | 0.004 |
| 5185 | 0.004 |
| 5186 | 0.01 |
| 5187 | 0.011 |
| 5188 | 0.012 |
| 5189 | 0.002 |
| 5190 | 0.002 |
| 5191 | 0.002 |
| 5192 | 0.001 |
| 5193 | 0.001 |
| 5194 | 0.002 |
| 5195 | 0.004 |
| 5196 | 0.002 |
| 5197 | 0.004 |
| 5198 | 0.005 |
| 5199 | 0.008 |
| 5200 | 0.005 |
| 5201 | 0.002 |
| 5202 | 0.005 |
| 5203 | 0.003 |
| 5204 | 0.002 |
| 5205 | 0.008 |
| 5206 | 0.006 |
| 5207 | 0.005 |
| 5208 | 0.006 |
| 5209 | 0.005 |
| 5210 | 0.002 |
| 5211 | 0.006 |
| 5212 | 0.005 |
| 5213 | 0.005 |
| 5214 | 0.003 |
| 5215 | 0.006 |
| 5216 | 0.005 |
| 5217 | 0.007 |
| 5218 | 0.007 |
| 5219 | 0.004 |
| 5220 | 0.002 |
| 5221 | 0.005 |
| 5222 | 0.006 |
| 5223 | 0.004 |
| 5224 | 0.003 |
| 5225 | 0.003 |
| 5226 | 0.003 |
| 5227 | 0.002 |
| 5228 | 0.006 |
| 5229 | 0.005 |
| 5230 | 0.004 |
| 5231 | 0.004 |
| 5232 | 0.003 |
| 5233 | 0.003 |
| 5234 | 0.001 |
| 5235 | 0.004 |
| 5236 | 0.005 |
| 5237 | 0.003 |
| 5238 | 0.001 |
| 5239 | 0.011 |
| 5240 | 0.005 |
| 5241 | 0.001 |
| 5242 | 0.005 |
| 5243 | 0.008 |
| 5244 | 0.012 |
| 5245 | 0.001 |
| 5246 | 0.001 |
| 5247 | 0.002 |
| 5248 | 0.004 |
| 5249 | 0.001 |
| 5250 | 0.004 |
| 5251 | 0.003 |
| 5252 | 0.001 |
| 5253 | 0.004 |
| 5254 | 0.006 |
| 5255 | 0.007 |
| 5256 | 0.004 |
| 5257 | 0.004 |
| 5258 | 0.003 |
| 5259 | 0.007 |
| 5260 | 0.003 |
| 5261 | 0.003 |
| 5262 | 0.003 |
| 5263 | 0.003 |
| 5264 | 0.005 |
| 5265 | 0.008 |
| 5266 | 0.006 |
| 5267 | 0.01 |
| 5268 | 0.007 |
| 5269 | 0.002 |
| 5270 | 0.002 |
| 5271 | 0.005 |
| 5272 | 0.008 |
| 5273 | 0.001 |
| 5274 | 0.003 |
| 5275 | 0.008 |
| 5276 | 0.004 |
| 5277 | 0.003 |
| 5278 | 0.007 |
| 5279 | 0.004 |
| 5280 | 0.003 |
| 5281 | 0.003 |
| 5282 | 0.005 |
| 5283 | 0.004 |
| 5284 | 0.004 |
| 5285 | 0.003 |
| 5286 | 0.009 |
| 5287 | 0.004 |
| 5288 | 0.004 |
| 5289 | 0.001 |
| 5290 | 0.009 |
| 5291 | 0.008 |
| 5292 | 0.002 |
| 5293 | 0.003 |
| 5294 | 0.005 |
| 5295 | 0.006 |
| 5296 | 0.003 |
| 5297 | 0.003 |
| 5298 | 0.005 |
| 5299 | 0.004 |
| 5300 | 0.002 |
| 5301 | 0.006 |
| 5302 | 0.004 |
| 5303 | 0.006 |
| 5304 | 0.005 |
| 5305 | 0.004 |
| 5306 | 0.006 |
| 5307 | 0.002 |
| 5308 | 0.002 |
| 5309 | 0.004 |
| 5310 | 0.005 |
| 5311 | 0.004 |
| 5312 | 0.001 |
| 5313 | 0.002 |
| 5314 | 0.004 |
| 5315 | 0.005 |
| 5316 | 0.003 |
| 5317 | 0.005 |
| 5318 | 0.004 |
| 5319 | 0.004 |
| 5320 | 0.001 |
| 5321 | 0.002 |
| 5322 | 0.005 |
| 5323 | 0.007 |
| 5324 | 0.002 |
| 5325 | 0.003 |
| 5326 | 0.009 |
| 5327 | 0.006 |
| 5328 | 0.001 |
| 5329 | 0.004 |
| 5330 | 0.004 |
| 5331 | 0.006 |
| 5332 | 0.001 |
| 5333 | 0.004 |
| 5334 | 0.002 |
| 5335 | 0.003 |
| 5336 | 0.003 |
| 5337 | 0.003 |
| 5338 | 0.007 |
| 5339 | 0.006 |
| 5340 | 0.001 |
| 5341 | 0.002 |
| 5342 | 0.002 |
| 5343 | 0.009 |
| 5344 | 0.013 |
| 5345 | 0.005 |
| 5346 | 0.004 |
| 5347 | 0.004 |
| 5348 | 0.007 |
| 5349 | 0.004 |
| 5350 | 0.006 |
| 5351 | 0.002 |
| 5352 | 0.006 |
| 5353 | 0.001 |
| 5354 | 0.003 |
| 5355 | 0.005 |
| 5356 | 0.005 |
| 5357 | 0.002 |
| 5358 | 0.001 |
| 5359 | 0.004 |
| 5360 | 0.005 |
| 5361 | 0.006 |
| 5362 | 0.003 |
| 5363 | 0.001 |
| 5364 | 0.004 |
| 5365 | 0.005 |
| 5366 | 0.004 |
| 5367 | 0.008 |
| 5368 | 0.002 |
| 5369 | 0.001 |
| 5370 | 0.005 |
| 5371 | 0.001 |
| 5372 | 0.005 |
| 5373 | 0.001 |
| 5374 | 0.004 |
| 5375 | 0.008 |
| 5376 | 0.003 |
| 5377 | 0.004 |
| 5378 | 0.003 |
| 5379 | 0.002 |
| 5380 | 0.003 |
| 5381 | 0.002 |
| 5382 | 0.001 |
| 5383 | 0.003 |
| 5384 | 0.001 |
| 5385 | 0.003 |
| 5386 | 0.002 |
| 5387 | 0.005 |
| 5388 | 0.002 |
| 5389 | 0.003 |
| 5390 | 0.005 |
| 5391 | 0.007 |
| 5392 | 0.002 |
| 5393 | 0.003 |
| 5394 | 0.004 |
| 5395 | 0.004 |
| 5396 | 0.001 |
| 5397 | 0.002 |
| 5398 | 0.002 |
| 5399 | 0.007 |
| 5400 | 0.006 |
| 5401 | 0.006 |
| 5402 | 0.006 |
| 5403 | 0.007 |
| 5404 | 0.002 |
| 5405 | 0.005 |
| 5406 | 0.006 |
| 5407 | 0.003 |
| 5408 | 0.004 |
| 5409 | 0.004 |
| 5410 | 0.007 |
| 5411 | 0.005 |
| 5412 | 0.003 |
| 5413 | 0.002 |
| 5414 | 0.003 |
| 5415 | 0.005 |
| 5416 | 0.003 |
| 5417 | 0.003 |
| 5418 | 0.003 |
| 5419 | 0.008 |
| 5420 | 0.006 |
| 5421 | 0.005 |
| 5422 | 0.011 |
| 5423 | 0.009 |
| 5424 | 0.003 |
| 5425 | 0.007 |
| 5426 | 0.007 |
| 5427 | 0.002 |
| 5428 | 0.003 |
| 5429 | 0.01 |
| 5430 | 0.005 |
| 5431 | 0.001 |
| 5432 | 0.002 |
| 5433 | 0.001 |
| 5434 | 0.004 |
| 5435 | 0.004 |
| 5436 | 0.004 |
| 5437 | 0.003 |
| 5438 | 0.004 |
| 5439 | 0.007 |
| 5440 | 0.003 |
| 5441 | 0.002 |
| 5442 | 0.003 |
| 5443 | 0.005 |
| 5444 | 0.003 |
| 5445 | 0.003 |
| 5446 | 0.006 |
| 5447 | 0.005 |
| 5448 | 0.006 |
| 5449 | 0.002 |
| 5450 | 0.006 |
| 5451 | 0.009 |
| 5452 | 0.001 |
| 5453 | 0.003 |
| 5454 | 0.003 |
| 5455 | 0.006 |
| 5456 | 0.004 |
| 5457 | 0.008 |
| 5458 | 0.005 |
| 5459 | 0.006 |
| 5460 | 0.004 |
| 5461 | 0.003 |
| 5462 | 0.004 |
| 5463 | 0.001 |
| 5464 | 0.009 |
| 5465 | 0.005 |
| 5466 | 0.005 |
| 5467 | 0.008 |
| 5468 | 0.002 |
| 5469 | 0.003 |
| 5470 | 0.003 |
| 5471 | 0.001 |
| 5472 | 0.002 |
| 5473 | 0.004 |
| 5474 | 0.003 |
| 5475 | 0.01 |
| 5476 | 0.007 |
| 5477 | 0.004 |
| 5478 | 0.006 |
| 5479 | 0.002 |
| 5480 | 0.001 |
| 5481 | 0.004 |
| 5482 | 0.004 |
| 5483 | 0.005 |
| 5484 | 0.003 |
| 5485 | 0.004 |
| 5486 | 0.005 |
| 5487 | 0.002 |
| 5488 | 0.008 |
| 5489 | 0.001 |
| 5490 | 0.003 |
| 5491 | 0.006 |
| 5492 | 0.004 |
| 5493 | 0.004 |
| 5494 | 0.004 |
| 5495 | 0.002 |
| 5496 | 0.005 |
| 5497 | 0.003 |
| 5498 | 0.004 |
| 5499 | 0.008 |
| 5500 | 0.006 |
| 5501 | 0.006 |
| 5502 | 0.005 |
| 5503 | 0.002 |
| 5504 | 0.002 |
| 5505 | 0.014 |
| 5506 | 0.014 |
| 5507 | 0.009 |
| 5508 | 0.002 |
| 5509 | 0.008 |
| 5510 | 0.008 |
| 5511 | 0.003 |
| 5512 | 0.007 |
| 5513 | 0.005 |
| 5514 | 0.006 |
| 5515 | 0.004 |
| 5516 | 0.006 |
| 5517 | 0.003 |
| 5518 | 0.003 |
| 5519 | 0.004 |
| 5520 | 0.004 |
| 5521 | 0.005 |
| 5522 | 0.001 |
| 5523 | 0.007 |
| 5524 | 0.006 |
| 5525 | 0.006 |
| 5526 | 0.011 |
| 5527 | 0.008 |
| 5528 | 0.003 |
| 5529 | 0.005 |
| 5530 | 0.011 |
| 5531 | 0.003 |
| 5532 | 0.002 |
| 5533 | 0.004 |
| 5534 | 0.006 |
| 5535 | 0.004 |
| 5536 | 0.002 |
| 5537 | 0.001 |
| 5538 | 0.012 |
| 5539 | 0.008 |
| 5540 | 0.008 |
| 5541 | 0.003 |
| 5542 | 0.002 |
| 5543 | 0.005 |
| 5544 | 0.005 |
| 5545 | 0.006 |
| 5546 | 0.008 |
| 5547 | 0.003 |
| 5548 | 0.002 |
| 5549 | 0.002 |
| 5550 | 0.007 |
| 5551 | 0.003 |
| 5552 | 0.001 |
| 5553 | 0.006 |
| 5554 | 0.006 |
| 5555 | 0.009 |
| 5556 | 0.003 |
| 5557 | 0.004 |
| 5558 | 0.009 |
| 5559 | 0.006 |
| 5560 | 0.001 |
| 5561 | 0.002 |
| 5562 | 0.006 |
| 5563 | 0.006 |
| 5564 | 0.002 |
| 5565 | 0.003 |
| 5566 | 0.008 |
| 5567 | 0.003 |
| 5568 | 0.003 |
| 5569 | 0.002 |
| 5570 | 0.003 |
| 5571 | 0.003 |
| 5572 | 0.001 |
| 5573 | 0.004 |
| 5574 | 0.013 |
| 5575 | 0.005 |
| 5576 | 0 |
| 5577 | 0.004 |
| 5578 | 0.005 |
| 5579 | 0.001 |
| 5580 | 0.002 |
| 5581 | 0.004 |
| 5582 | 0.006 |
| 5583 | 0.003 |
| 5584 | 0.003 |
| 5585 | 0.007 |
| 5586 | 0.002 |
| 5587 | 0.003 |
| 5588 | 0.001 |
| 5589 | 0.002 |
| 5590 | 0.005 |
| 5591 | 0.001 |
| 5592 | 0.005 |
| 5593 | 0.005 |
| 5594 | 0.009 |
| 5595 | 0.005 |
| 5596 | 0.002 |
| 5597 | 0.003 |
| 5598 | 0.006 |
| 5599 | 0.006 |
| 5600 | 0.002 |
| 5601 | 0.005 |
| 5602 | 0.006 |
| 5603 | 0.009 |
| 5604 | 0.003 |
| 5605 | 0.004 |
| 5606 | 0.006 |
| 5607 | 0.006 |
| 5608 | 0.002 |
| 5609 | 0 |
| 5610 | 0.002 |
| 5611 | 0.003 |
| 5612 | 0.001 |
| 5613 | 0.001 |
| 5614 | 0.007 |
| 5615 | 0.007 |
| 5616 | 0.005 |
| 5617 | 0.006 |
| 5618 | 0.005 |
| 5619 | 0.006 |
| 5620 | 0.002 |
| 5621 | 0.004 |
| 5622 | 0.006 |
| 5623 | 0.006 |
| 5624 | 0.003 |
| 5625 | 0.001 |
| 5626 | 0.003 |
| 5627 | 0.004 |
| 5628 | 0.003 |
| 5629 | 0.003 |
| 5630 | 0.007 |
| 5631 | 0.007 |
| 5632 | 0.004 |
| 5633 | 0.005 |
| 5634 | 0.002 |
| 5635 | 0.004 |
| 5636 | 0.007 |
| 5637 | 0.004 |
| 5638 | 0.002 |
| 5639 | 0.003 |
| 5640 | 0.004 |
| 5641 | 0.001 |
| 5642 | 0.011 |
| 5643 | 0.005 |
| 5644 | 0.003 |
| 5645 | 0.001 |
| 5646 | 0.008 |
| 5647 | 0.01 |
| 5648 | 0.002 |
| 5649 | 0.003 |
| 5650 | 0.005 |
| 5651 | 0.004 |
| 5652 | 0.001 |
| 5653 | 0.004 |
| 5654 | 0.004 |
| 5655 | 0.005 |
| 5656 | 0.003 |
| 5657 | 0.003 |
| 5658 | 0.003 |
| 5659 | 0.007 |
| 5660 | 0.005 |
| 5661 | 0.005 |
| 5662 | 0.007 |
| 5663 | 0.007 |
| 5664 | 0.003 |
| 5665 | 0.002 |
| 5666 | 0.003 |
| 5667 | 0.005 |
| 5668 | 0.003 |
| 5669 | 0.003 |
| 5670 | 0.01 |
| 5671 | 0.004 |
| 5672 | 0.001 |
| 5673 | 0.001 |
| 5674 | 0.005 |
| 5675 | 0.002 |
| 5676 | 0.001 |
| 5677 | 0.004 |
| 5678 | 0.009 |
| 5679 | 0.008 |
| 5680 | 0.005 |
| 5681 | 0.006 |
| 5682 | 0.004 |
| 5683 | 0.005 |
| 5684 | 0.002 |
| 5685 | 0.003 |
| 5686 | 0.003 |
| 5687 | 0.006 |
| 5688 | 0.004 |
| 5689 | 0.003 |
| 5690 | 0.005 |
| 5691 | 0.004 |
| 5692 | 0.001 |
| 5693 | 0.002 |
| 5694 | 0.007 |
| 5695 | 0.004 |
| 5696 | 0.007 |
| 5697 | 0.008 |
| 5698 | 0.003 |
| 5699 | 0.002 |
| 5700 | 0.004 |
| 5701 | 0.002 |
| 5702 | 0.003 |
| 5703 | 0.004 |
| 5704 | 0.006 |
| 5705 | 0.005 |
| 5706 | 0.005 |
| 5707 | 0.009 |
| 5708 | 0.011 |
| 5709 | 0.004 |
| 5710 | 0.003 |
| 5711 | 0.007 |
| 5712 | 0.007 |
| 5713 | 0.003 |
| 5714 | 0.002 |
| 5715 | 0.003 |
| 5716 | 0.004 |
| 5717 | 0.007 |
| 5718 | 0.008 |
| 5719 | 0.009 |
| 5720 | 0.002 |
| 5721 | 0.002 |
| 5722 | 0.005 |
| 5723 | 0.002 |
| 5724 | 0.004 |
| 5725 | 0.002 |
| 5726 | 0.002 |
| 5727 | 0.002 |
| 5728 | 0.003 |
| 5729 | 0.002 |
| 5730 | 0.002 |
| 5731 | 0.005 |
| 5732 | 0.005 |
| 5733 | 0.004 |
| 5734 | 0.007 |
| 5735 | 0.009 |
| 5736 | 0.011 |
| 5737 | 0.003 |
| 5738 | 0.003 |
| 5739 | 0.004 |
| 5740 | 0.009 |
| 5741 | 0.003 |
| 5742 | 0.004 |
| 5743 | 0.004 |
| 5744 | 0.003 |
| 5745 | 0.001 |
| 5746 | 0.004 |
| 5747 | 0.003 |
| 5748 | 0.001 |
| 5749 | 0.002 |
| 5750 | 0.007 |
| 5751 | 0.005 |
| 5752 | 0.006 |
| 5753 | 0.003 |
| 5754 | 0.002 |
| 5755 | 0.006 |
| 5756 | 0.001 |
| 5757 | 0.002 |
| 5758 | 0.003 |
| 5759 | 0.002 |
| 5760 | 0.003 |
| 5761 | 0.002 |
| 5762 | 0.002 |
| 5763 | 0.001 |
| 5764 | 0.005 |
| 5765 | 0.007 |
| 5766 | 0.004 |
| 5767 | 0.002 |
| 5768 | 0.003 |
| 5769 | 0.003 |
| 5770 | 0.002 |
| 5771 | 0.006 |
| 5772 | 0.003 |
| 5773 | 0.005 |
| 5774 | 0.008 |
| 5775 | 0.004 |
| 5776 | 0.005 |
| 5777 | 0.002 |
| 5778 | 0.004 |
| 5779 | 0.005 |
| 5780 | 0.007 |
| 5781 | 0.008 |
| 5782 | 0.003 |
| 5783 | 0.005 |
| 5784 | 0.006 |
| 5785 | 0.004 |
| 5786 | 0.005 |
| 5787 | 0.005 |
| 5788 | 0.013 |
| 5789 | 0.005 |
| 5790 | 0.003 |
| 5791 | 0.008 |
| 5792 | 0.006 |
| 5793 | 0.004 |
| 5794 | 0.005 |
| 5795 | 0.008 |
| 5796 | 0.003 |
| 5797 | 0.006 |
| 5798 | 0.004 |
| 5799 | 0.003 |
| 5800 | 0.003 |
| 5801 | 0.003 |
| 5802 | 0.004 |
| 5803 | 0.004 |
| 5804 | 0.012 |
| 5805 | 0.009 |
| 5806 | 0.004 |
| 5807 | 0.007 |
| 5808 | 0.005 |
| 5809 | 0.009 |
| 5810 | 0.006 |
| 5811 | 0.002 |
| 5812 | 0.003 |
| 5813 | 0.008 |
| 5814 | 0.007 |
| 5815 | 0.006 |
| 5816 | 0.004 |
| 5817 | 0.004 |
| 5818 | 0.009 |
| 5819 | 0.003 |
| 5820 | 0.011 |
| 5821 | 0.003 |
| 5822 | 0.007 |
| 5823 | 0.003 |
| 5824 | 0.005 |
| 5825 | 0.005 |
| 5826 | 0.005 |
| 5827 | 0.009 |
| 5828 | 0.003 |
| 5829 | 0.004 |
| 5830 | 0.002 |
| 5831 | 0.003 |
| 5832 | 0.004 |
| 5833 | 0.002 |
| 5834 | 0.002 |
| 5835 | 0.011 |
| 5836 | 0.004 |
| 5837 | 0.003 |
| 5838 | 0.005 |
| 5839 | 0.005 |
| 5840 | 0.001 |
| 5841 | 0.002 |
| 5842 | 0.003 |
| 5843 | 0.003 |
| 5844 | 0.002 |
| 5845 | 0.001 |
| 5846 | 0.004 |
| 5847 | 0.007 |
| 5848 | 0.002 |
| 5849 | 0.001 |
| 5850 | 0.004 |
| 5851 | 0.005 |
| 5852 | 0.004 |
| 5853 | 0.003 |
| 5854 | 0.001 |
| 5855 | 0.005 |
| 5856 | 0.004 |
| 5857 | 0.005 |
| 5858 | 0.002 |
| 5859 | 0.004 |
| 5860 | 0.002 |
| 5861 | 0.004 |
| 5862 | 0.007 |
| 5863 | 0.011 |
| 5864 | 0.002 |
| 5865 | 0.002 |
| 5866 | 0.003 |
| 5867 | 0.004 |
| 5868 | 0.004 |
| 5869 | 0.004 |
| 5870 | 0.007 |
| 5871 | 0.006 |
| 5872 | 0.004 |
| 5873 | 0.003 |
| 5874 | 0.005 |
| 5875 | 0.004 |
| 5876 | 0.006 |
| 5877 | 0.004 |
| 5878 | 0.004 |
| 5879 | 0.004 |
| 5880 | 0.001 |
| 5881 | 0.004 |
| 5882 | 0.002 |
| 5883 | 0.004 |
| 5884 | 0.004 |
| 5885 | 0.005 |
| 5886 | 0.008 |
| 5887 | 0.009 |
| 5888 | 0.003 |
| 5889 | 0.003 |
| 5890 | 0.006 |
| 5891 | 0.001 |
| 5892 | 0.004 |
| 5893 | 0.003 |
| 5894 | 0.008 |
| 5895 | 0.007 |
| 5896 | 0.002 |
| 5897 | 0.004 |
| 5898 | 0.005 |
| 5899 | 0.005 |
| 5900 | 0.004 |
| 5901 | 0.01 |
| 5902 | 0.006 |
| 5903 | 0.004 |
| 5904 | 0.003 |
| 5905 | 0.005 |
| 5906 | 0.009 |
| 5907 | 0.008 |
| 5908 | 0.004 |
| 5909 | 0.004 |
| 5910 | 0.004 |
| 5911 | 0.002 |
| 5912 | 0.003 |
| 5913 | 0.003 |
| 5914 | 0.008 |
| 5915 | 0.005 |
| 5916 | 0.002 |
| 5917 | 0.003 |
| 5918 | 0.01 |
| 5919 | 0.007 |
| 5920 | 0.003 |
| 5921 | 0.005 |
| 5922 | 0.006 |
| 5923 | 0.012 |
| 5924 | 0.003 |
| 5925 | 0.003 |
| 5926 | 0.004 |
| 5927 | 0.005 |
| 5928 | 0.002 |
| 5929 | 0.002 |
| 5930 | 0.004 |
| 5931 | 0.005 |
| 5932 | 0.004 |
| 5933 | 0.002 |
| 5934 | 0.001 |
| 5935 | 0.003 |
| 5936 | 0.002 |
| 5937 | 0.002 |
| 5938 | 0.007 |
| 5939 | 0.006 |
| 5940 | 0.004 |
| 5941 | 0.003 |
| 5942 | 0.009 |
| 5943 | 0.003 |
| 5944 | 0.012 |
| 5945 | 0.006 |
| 5946 | 0.006 |
| 5947 | 0.008 |
| 5948 | 0.004 |
| 5949 | 0.005 |
| 5950 | 0.007 |
| 5951 | 0.002 |
| 5952 | 0.001 |
| 5953 | 0.005 |
| 5954 | 0.005 |
| 5955 | 0.005 |
| 5956 | 0.005 |
| 5957 | 0.005 |
| 5958 | 0.002 |
| 5959 | 0.007 |
| 5960 | 0.002 |
| 5961 | 0.001 |
| 5962 | 0.005 |
| 5963 | 0.005 |
| 5964 | 0.003 |
| 5965 | 0.002 |
| 5966 | 0.003 |
| 5967 | 0.009 |
| 5968 | 0.001 |
| 5969 | 0.004 |
| 5970 | 0.002 |
| 5971 | 0.009 |
| 5972 | 0.005 |
| 5973 | 0.005 |
| 5974 | 0.004 |
| 5975 | 0.004 |
| 5976 | 0.005 |
| 5977 | 0.002 |
| 5978 | 0.005 |
| 5979 | 0.009 |
| 5980 | 0.004 |
| 5981 | 0.006 |
| 5982 | 0.004 |
| 5983 | 0.005 |
| 5984 | 0.004 |
| 5985 | 0.004 |
| 5986 | 0.004 |
| 5987 | 0.005 |
| 5988 | 0.003 |
| 5989 | 0.003 |
| 5990 | 0.003 |
| 5991 | 0.003 |
| 5992 | 0.002 |
| 5993 | 0.002 |
| 5994 | 0.003 |
| 5995 | 0.004 |
| 5996 | 0.001 |
| 5997 | 0.002 |
| 5998 | 0.007 |
| 5999 | 0.006 |
| 6000 | 0.005 |
| 6001 | 0.005 |
| 6002 | 0.008 |
| 6003 | 0.011 |
| 6004 | 0.002 |
| 6005 | 0.004 |
| 6006 | 0.006 |
| 6007 | 0.008 |
| 6008 | 0.002 |
| 6009 | 0.001 |
| 6010 | 0.005 |
| 6011 | 0.004 |
| 6012 | 0.004 |
| 6013 | 0.003 |
| 6014 | 0.006 |
| 6015 | 0.001 |
| 6016 | 0.003 |
| 6017 | 0.003 |
| 6018 | 0.005 |
| 6019 | 0.003 |
| 6020 | 0.003 |
| 6021 | 0.002 |
| 6022 | 0.005 |
| 6023 | 0.003 |
| 6024 | 0.004 |
| 6025 | 0.003 |
| 6026 | 0.002 |
| 6027 | 0.008 |
| 6028 | 0.002 |
| 6029 | 0.008 |
| 6030 | 0.003 |
| 6031 | 0.003 |
| 6032 | 0.003 |
| 6033 | 0.003 |
| 6034 | 0.007 |
| 6035 | 0.006 |
| 6036 | 0.003 |
| 6037 | 0.003 |
| 6038 | 0.004 |
| 6039 | 0.003 |
| 6040 | 0.005 |
| 6041 | 0.003 |
| 6042 | 0.002 |
| 6043 | 0.002 |
| 6044 | 0.007 |
| 6045 | 0.003 |
| 6046 | 0.003 |
| 6047 | 0.009 |
| 6048 | 0.004 |
| 6049 | 0.003 |
| 6050 | 0.001 |
| 6051 | 0.004 |
| 6052 | 0.001 |
| 6053 | 0.004 |
| 6054 | 0.004 |
| 6055 | 0.006 |
| 6056 | 0.001 |
| 6057 | 0.005 |
| 6058 | 0.003 |
| 6059 | 0.007 |
| 6060 | 0.002 |
| 6061 | 0.001 |
| 6062 | 0.003 |
| 6063 | 0.001 |
| 6064 | 0.006 |
| 6065 | 0.004 |
| 6066 | 0.007 |
| 6067 | 0.005 |
| 6068 | 0.006 |
| 6069 | 0.004 |
| 6070 | 0.006 |
| 6071 | 0.003 |
| 6072 | 0.003 |
| 6073 | 0.002 |
| 6074 | 0.002 |
| 6075 | 0.001 |
| 6076 | 0.005 |
| 6077 | 0.006 |
| 6078 | 0.003 |
| 6079 | 0.004 |
| 6080 | 0.004 |
| 6081 | 0.002 |
| 6082 | 0.006 |
| 6083 | 0.002 |
| 6084 | 0.006 |
| 6085 | 0.006 |
| 6086 | 0.004 |
| 6087 | 0.004 |
| 6088 | 0.004 |
| 6089 | 0.005 |
| 6090 | 0.005 |
| 6091 | 0.007 |
| 6092 | 0.008 |
| 6093 | 0.006 |
| 6094 | 0.007 |
| 6095 | 0.008 |
| 6096 | 0.008 |
| 6097 | 0.005 |
| 6098 | 0.004 |
| 6099 | 0.003 |
| 6100 | 0.008 |
| 6101 | 0.003 |
| 6102 | 0.008 |
| 6103 | 0.004 |
| 6104 | 0.003 |
| 6105 | 0.003 |
| 6106 | 0.002 |
| 6107 | 0.003 |
| 6108 | 0.007 |
| 6109 | 0.004 |
| 6110 | 0.006 |
| 6111 | 0.003 |
| 6112 | 0.006 |
| 6113 | 0.002 |
| 6114 | 0.006 |
| 6115 | 0.003 |
| 6116 | 0.006 |
| 6117 | 0.006 |
| 6118 | 0.003 |
| 6119 | 0.003 |
| 6120 | 0.009 |
| 6121 | 0.008 |
| 6122 | 0.007 |
| 6123 | 0.008 |
| 6124 | 0.003 |
| 6125 | 0.005 |
| 6126 | 0.003 |
| 6127 | 0.006 |
| 6128 | 0.002 |
| 6129 | 0.005 |
| 6130 | 0.009 |
| 6131 | 0.004 |
| 6132 | 0.001 |
| 6133 | 0.004 |
| 6134 | 0.004 |
| 6135 | 0.002 |
| 6136 | 0.003 |
| 6137 | 0.004 |
| 6138 | 0.006 |
| 6139 | 0.003 |
| 6140 | 0.003 |
| 6141 | 0.002 |
| 6142 | 0 |
| 6143 | 0.005 |
| 6144 | 0.01 |
| 6145 | 0.012 |
| 6146 | 0.008 |
| 6147 | 0.008 |
| 6148 | 0.007 |
| 6149 | 0.005 |
| 6150 | 0.005 |
| 6151 | 0.002 |
| 6152 | 0.005 |
| 6153 | 0.003 |
| 6154 | 0.003 |
| 6155 | 0.004 |
| 6156 | 0.002 |
| 6157 | 0.002 |
| 6158 | 0.003 |
| 6159 | 0.004 |
| 6160 | 0.004 |
| 6161 | 0.002 |
| 6162 | 0.009 |
| 6163 | 0.011 |
| 6164 | 0.002 |
| 6165 | 0.003 |
| 6166 | 0.003 |
| 6167 | 0.005 |
| 6168 | 0.003 |
| 6169 | 0.001 |
| 6170 | 0.005 |
| 6171 | 0.002 |
| 6172 | 0.001 |
| 6173 | 0.008 |
| 6174 | 0.006 |
| 6175 | 0.009 |
| 6176 | 0.002 |
| 6177 | 0.004 |
| 6178 | 0.007 |
| 6179 | 0.004 |
| 6180 | 0.001 |
| 6181 | 0.001 |
| 6182 | 0.004 |
| 6183 | 0.007 |
| 6184 | 0.005 |
| 6185 | 0.004 |
| 6186 | 0.005 |
| 6187 | 0.006 |
| 6188 | 0.003 |
| 6189 | 0.004 |
| 6190 | 0.004 |
| 6191 | 0.001 |
| 6192 | 0.002 |
| 6193 | 0.003 |
| 6194 | 0.003 |
| 6195 | 0.007 |
| 6196 | 0.004 |
| 6197 | 0.004 |
| 6198 | 0.002 |
| 6199 | 0.003 |
| 6200 | 0.003 |
| 6201 | 0.002 |
| 6202 | 0.003 |
| 6203 | 0.008 |
| 6204 | 0.004 |
| 6205 | 0.003 |
| 6206 | 0.002 |
| 6207 | 0.002 |
| 6208 | 0.006 |
| 6209 | 0.005 |
| 6210 | 0.004 |
| 6211 | 0.003 |
| 6212 | 0.002 |
| 6213 | 0.002 |
| 6214 | 0.003 |
| 6215 | 0.008 |
| 6216 | 0.002 |
| 6217 | 0.007 |
| 6218 | 0.009 |
| 6219 | 0.006 |
| 6220 | 0.002 |
| 6221 | 0.001 |
| 6222 | 0.005 |
| 6223 | 0.004 |
| 6224 | 0.005 |
| 6225 | 0.007 |
| 6226 | 0.012 |
| 6227 | 0.005 |
| 6228 | 0.001 |
| 6229 | 0.009 |
| 6230 | 0.006 |
| 6231 | 0.002 |
| 6232 | 0.009 |
| 6233 | 0.004 |
| 6234 | 0.007 |
| 6235 | 0.007 |
| 6236 | 0.001 |
| 6237 | 0.002 |
| 6238 | 0.003 |
| 6239 | 0.002 |
| 6240 | 0.002 |
| 6241 | 0.003 |
| 6242 | 0.007 |
| 6243 | 0.01 |
| 6244 | 0.002 |
| 6245 | 0.003 |
| 6246 | 0.002 |
| 6247 | 0.002 |
| 6248 | 0.002 |
| 6249 | 0.003 |
| 6250 | 0.004 |
| 6251 | 0.005 |
| 6252 | 0.002 |
| 6253 | 0.002 |
| 6254 | 0.008 |
| 6255 | 0.009 |
| 6256 | 0.001 |
| 6257 | 0.004 |
| 6258 | 0.004 |
| 6259 | 0.003 |
| 6260 | 0.008 |
| 6261 | 0.004 |
| 6262 | 0.005 |
| 6263 | 0.005 |
| 6264 | 0.001 |
| 6265 | 0.004 |
| 6266 | 0.003 |
| 6267 | 0.007 |
| 6268 | 0.002 |
| 6269 | 0.008 |
| 6270 | 0.006 |
| 6271 | 0.005 |
| 6272 | 0.002 |
| 6273 | 0.006 |
| 6274 | 0.011 |
| 6275 | 0.008 |
| 6276 | 0.003 |
| 6277 | 0.004 |
| 6278 | 0.006 |
| 6279 | 0.003 |
| 6280 | 0.004 |
| 6281 | 0.007 |
| 6282 | 0.003 |
| 6283 | 0.002 |
| 6284 | 0.004 |
| 6285 | 0.003 |
| 6286 | 0.004 |
| 6287 | 0.004 |
| 6288 | 0.007 |
| 6289 | 0.002 |
| 6290 | 0.002 |
| 6291 | 0.004 |
| 6292 | 0.005 |
| 6293 | 0.004 |
| 6294 | 0.003 |
| 6295 | 0.005 |
| 6296 | 0.004 |
| 6297 | 0.003 |
| 6298 | 0.007 |
| 6299 | 0.006 |
| 6300 | 0.003 |
| 6301 | 0.003 |
| 6302 | 0.009 |
| 6303 | 0.007 |
| 6304 | 0.002 |
| 6305 | 0.002 |
| 6306 | 0.008 |
| 6307 | 0.007 |
| 6308 | 0.001 |
| 6309 | 0.003 |
| 6310 | 0.002 |
| 6311 | 0.002 |
| 6312 | 0.001 |
| 6313 | 0.005 |
| 6314 | 0.005 |
| 6315 | 0.003 |
| 6316 | 0.003 |
| 6317 | 0.002 |
| 6318 | 0.002 |
| 6319 | 0.001 |
| 6320 | 0.002 |
| 6321 | 0.003 |
| 6322 | 0.009 |
| 6323 | 0.005 |
| 6324 | 0.003 |
| 6325 | 0.006 |
| 6326 | 0.008 |
| 6327 | 0.004 |
| 6328 | 0.003 |
| 6329 | 0.002 |
| 6330 | 0.007 |
| 6331 | 0.009 |
| 6332 | 0.001 |
| 6333 | 0.001 |
| 6334 | 0.004 |
| 6335 | 0.003 |
| 6336 | 0.001 |
| 6337 | 0.003 |
| 6338 | 0.001 |
| 6339 | 0.001 |
| 6340 | 0.004 |
| 6341 | 0.003 |
| 6342 | 0.005 |
| 6343 | 0.006 |
| 6344 | 0.005 |
| 6345 | 0.002 |
| 6346 | 0.006 |
| 6347 | 0.007 |
| 6348 | 0.005 |
| 6349 | 0.003 |
| 6350 | 0.006 |
| 6351 | 0.006 |
| 6352 | 0.001 |
| 6353 | 0.002 |
| 6354 | 0.003 |
| 6355 | 0.009 |
| 6356 | 0.002 |
| 6357 | 0.004 |
| 6358 | 0.003 |
| 6359 | 0.006 |
| 6360 | 0.003 |
| 6361 | 0.006 |
| 6362 | 0.002 |
| 6363 | 0.007 |
| 6364 | 0.004 |
| 6365 | 0.003 |
| 6366 | 0.004 |
| 6367 | 0.005 |
| 6368 | 0.003 |
| 6369 | 0.006 |
| 6370 | 0.007 |
| 6371 | 0.009 |
| 6372 | 0.005 |
| 6373 | 0.006 |
| 6374 | 0.004 |
| 6375 | 0.003 |
| 6376 | 0.006 |
| 6377 | 0.002 |
| 6378 | 0.003 |
| 6379 | 0.004 |
| 6380 | 0.005 |
| 6381 | 0.005 |
| 6382 | 0.001 |
| 6383 | 0.006 |
| 6384 | 0.002 |
| 6385 | 0.001 |
| 6386 | 0.002 |
| 6387 | 0.001 |
| 6388 | 0.004 |
| 6389 | 0.005 |
| 6390 | 0.004 |
| 6391 | 0.005 |
| 6392 | 0.003 |
| 6393 | 0.009 |
| 6394 | 0.002 |
| 6395 | 0.005 |
| 6396 | 0.005 |
| 6397 | 0.005 |
| 6398 | 0.004 |
| 6399 | 0.003 |
| 6400 | 0.005 |
| 6401 | 0.006 |
| 6402 | 0.007 |
| 6403 | 0.006 |
| 6404 | 0.004 |
| 6405 | 0.006 |
| 6406 | 0.002 |
| 6407 | 0.002 |
| 6408 | 0.002 |
| 6409 | 0.002 |
| 6410 | 0.006 |
| 6411 | 0.005 |
| 6412 | 0.003 |
| 6413 | 0.006 |
| 6414 | 0.004 |
| 6415 | 0.009 |
| 6416 | 0.006 |
| 6417 | 0.009 |
| 6418 | 0.003 |
| 6419 | 0.006 |
| 6420 | 0.004 |
| 6421 | 0.004 |
| 6422 | 0.004 |
| 6423 | 0.005 |
| 6424 | 0.005 |
| 6425 | 0.003 |
| 6426 | 0.007 |
| 6427 | 0.004 |
| 6428 | 0.007 |
| 6429 | 0.007 |
| 6430 | 0.004 |
| 6431 | 0.004 |
| 6432 | 0.01 |
| 6433 | 0.004 |
| 6434 | 0.002 |
| 6435 | 0.003 |
| 6436 | 0.004 |
| 6437 | 0.003 |
| 6438 | 0.001 |
| 6439 | 0.004 |
| 6440 | 0.01 |
| 6441 | 0.003 |
| 6442 | 0.002 |
| 6443 | 0.006 |
| 6444 | 0.005 |
| 6445 | 0.005 |
| 6446 | 0.005 |
| 6447 | 0.005 |
| 6448 | 0.004 |
| 6449 | 0.004 |
| 6450 | 0.002 |
| 6451 | 0.001 |
| 6452 | 0.007 |
| 6453 | 0.002 |
| 6454 | 0.004 |
| 6455 | 0.004 |
| 6456 | 0.003 |
| 6457 | 0.004 |
| 6458 | 0.008 |
| 6459 | 0.006 |
| 6460 | 0.001 |
| 6461 | 0.003 |
| 6462 | 0.001 |
| 6463 | 0.009 |
| 6464 | 0.003 |
| 6465 | 0.004 |
| 6466 | 0.002 |
| 6467 | 0.007 |
| 6468 | 0.005 |
| 6469 | 0.004 |
| 6470 | 0.004 |
| 6471 | 0.002 |
| 6472 | 0.006 |
| 6473 | 0.008 |
| 6474 | 0.006 |
| 6475 | 0.002 |
| 6476 | 0.004 |
| 6477 | 0.004 |
| 6478 | 0.003 |
| 6479 | 0.003 |
| 6480 | 0.002 |
| 6481 | 0.001 |
| 6482 | 0.004 |
| 6483 | 0.003 |
| 6484 | 0.002 |
| 6485 | 0.006 |
| 6486 | 0.001 |
| 6487 | 0.009 |
| 6488 | 0.001 |
| 6489 | 0.002 |
| 6490 | 0.008 |
| 6491 | 0.004 |
| 6492 | 0.004 |
| 6493 | 0.005 |
| 6494 | 0.003 |
| 6495 | 0.004 |
| 6496 | 0.001 |
| 6497 | 0.003 |
| 6498 | 0.002 |
| 6499 | 0.004 |
| 6500 | 0.002 |
| 6501 | 0.002 |
| 6502 | 0.005 |
| 6503 | 0.003 |
| 6504 | 0.002 |
| 6505 | 0.006 |
| 6506 | 0.003 |
| 6507 | 0.004 |
| 6508 | 0.004 |
| 6509 | 0.006 |
| 6510 | 0.007 |
| 6511 | 0.006 |
| 6512 | 0.002 |
| 6513 | 0.003 |
| 6514 | 0.007 |
| 6515 | 0.006 |
| 6516 | 0.004 |
| 6517 | 0.005 |
| 6518 | 0.008 |
| 6519 | 0.005 |
| 6520 | 0.001 |
| 6521 | 0.008 |
| 6522 | 0.006 |
| 6523 | 0.004 |
| 6524 | 0.004 |
| 6525 | 0.003 |
| 6526 | 0.004 |
| 6527 | 0.006 |
| 6528 | 0.003 |
| 6529 | 0.004 |
| 6530 | 0.013 |
| 6531 | 0.011 |
| 6532 | 0.002 |
| 6533 | 0.004 |
| 6534 | 0.006 |
| 6535 | 0.005 |
| 6536 | 0.002 |
| 6537 | 0.002 |
| 6538 | 0.006 |
| 6539 | 0.007 |
| 6540 | 0.003 |
| 6541 | 0.007 |
| 6542 | 0.005 |
| 6543 | 0.007 |
| 6544 | 0.008 |
| 6545 | 0.004 |
| 6546 | 0.001 |
| 6547 | 0.001 |
| 6548 | 0.001 |
| 6549 | 0.001 |
| 6550 | 0.004 |
| 6551 | 0.003 |
| 6552 | 0.002 |
| 6553 | 0.002 |
| 6554 | 0.009 |
| 6555 | 0.005 |
| 6556 | 0.002 |
| 6557 | 0.002 |
| 6558 | 0.006 |
| 6559 | 0.005 |
| 6560 | 0.003 |
| 6561 | 0.003 |
| 6562 | 0.004 |
| 6563 | 0.005 |
| 6564 | 0.006 |
| 6565 | 0.002 |
| 6566 | 0.003 |
| 6567 | 0.004 |
| 6568 | 0.001 |
| 6569 | 0.002 |
| 6570 | 0.006 |
| 6571 | 0.005 |
| 6572 | 0.004 |
| 6573 | 0.005 |
| 6574 | 0.008 |
| 6575 | 0.012 |
| 6576 | 0.001 |
| 6577 | 0.002 |
| 6578 | 0.003 |
| 6579 | 0.007 |
| 6580 | 0.005 |
| 6581 | 0 |
| 6582 | 0.004 |
| 6583 | 0.005 |
| 6584 | 0.002 |
| 6585 | 0.002 |
| 6586 | 0.003 |
| 6587 | 0.003 |
| 6588 | 0.003 |
| 6589 | 0.003 |
| 6590 | 0.004 |
| 6591 | 0.007 |
| 6592 | 0.002 |
| 6593 | 0.007 |
| 6594 | 0.007 |
| 6595 | 0.006 |
| 6596 | 0.002 |
| 6597 | 0.001 |
| 6598 | 0.001 |
| 6599 | 0.003 |
| 6600 | 0.002 |
| 6601 | 0.004 |
| 6602 | 0.006 |
| 6603 | 0.006 |
| 6604 | 0.001 |
| 6605 | 0.001 |
| 6606 | 0.009 |
| 6607 | 0.007 |
| 6608 | 0.002 |
| 6609 | 0.004 |
| 6610 | 0.008 |
| 6611 | 0.007 |
| 6612 | 0.002 |
| 6613 | 0.003 |
| 6614 | 0.004 |
| 6615 | 0.005 |
| 6616 | 0.002 |
| 6617 | 0.003 |
| 6618 | 0.007 |
| 6619 | 0.004 |
| 6620 | 0.003 |
| 6621 | 0.004 |
| 6622 | 0.006 |
| 6623 | 0.004 |
| 6624 | 0.003 |
| 6625 | 0.003 |
| 6626 | 0.005 |
| 6627 | 0.008 |
| 6628 | 0.002 |
| 6629 | 0.003 |
| 6630 | 0.008 |
| 6631 | 0.004 |
| 6632 | 0.005 |
| 6633 | 0.002 |
| 6634 | 0.003 |
| 6635 | 0.004 |
| 6636 | 0.005 |
| 6637 | 0.002 |
| 6638 | 0.003 |
| 6639 | 0.007 |
| 6640 | 0.003 |
| 6641 | 0.004 |
| 6642 | 0.002 |
| 6643 | 0.002 |
| 6644 | 0.003 |
| 6645 | 0.002 |
| 6646 | 0.006 |
| 6647 | 0.007 |
| 6648 | 0.005 |
| 6649 | 0.002 |
| 6650 | 0.003 |
| 6651 | 0.001 |
| 6652 | 0.011 |
| 6653 | 0.003 |
| 6654 | 0.006 |
| 6655 | 0.002 |
| 6656 | 0.011 |
| 6657 | 0.003 |
| 6658 | 0.003 |
| 6659 | 0.003 |
| 6660 | 0.005 |
| 6661 | 0.001 |
| 6662 | 0.006 |
| 6663 | 0.003 |
| 6664 | 0.006 |
| 6665 | 0.001 |
| 6666 | 0.002 |
| 6667 | 0.003 |
| 6668 | 0.003 |
| 6669 | 0.005 |
| 6670 | 0.004 |
| 6671 | 0.002 |
| 6672 | 0.005 |
| 6673 | 0.006 |
| 6674 | 0.007 |
| 6675 | 0.004 |
| 6676 | 0.009 |
| 6677 | 0.006 |
| 6678 | 0.007 |
| 6679 | 0.011 |
| 6680 | 0.005 |
| 6681 | 0.002 |
| 6682 | 0.004 |
| 6683 | 0.004 |
| 6684 | 0.003 |
| 6685 | 0.002 |
| 6686 | 0.002 |
| 6687 | 0.003 |
| 6688 | 0.004 |
| 6689 | 0.011 |
| 6690 | 0.002 |
| 6691 | 0.002 |
| 6692 | 0.003 |
| 6693 | 0.005 |
| 6694 | 0.002 |
| 6695 | 0.004 |
| 6696 | 0.006 |
| 6697 | 0.002 |
| 6698 | 0.003 |
| 6699 | 0.004 |
| 6700 | 0.006 |
| 6701 | 0.002 |
| 6702 | 0.008 |
| 6703 | 0.006 |
| 6704 | 0.002 |
| 6705 | 0.002 |
| 6706 | 0.004 |
| 6707 | 0.003 |
| 6708 | 0.005 |
| 6709 | 0.006 |
| 6710 | 0.004 |
| 6711 | 0.003 |
| 6712 | 0.003 |
| 6713 | 0.002 |
| 6714 | 0.004 |
| 6715 | 0.005 |
| 6716 | 0.004 |
| 6717 | 0.002 |
| 6718 | 0.005 |
| 6719 | 0.011 |
| 6720 | 0.004 |
| 6721 | 0.003 |
| 6722 | 0.005 |
| 6723 | 0.007 |
| 6724 | 0.005 |
| 6725 | 0.003 |
| 6726 | 0.005 |
| 6727 | 0.003 |
| 6728 | 0.007 |
| 6729 | 0.009 |
| 6730 | 0.005 |
| 6731 | 0.005 |
| 6732 | 0.011 |
| 6733 | 0.002 |
| 6734 | 0.006 |
| 6735 | 0.005 |
| 6736 | 0.006 |
| 6737 | 0.008 |
| 6738 | 0.004 |
| 6739 | 0.006 |
| 6740 | 0.003 |
| 6741 | 0.004 |
| 6742 | 0.001 |
| 6743 | 0.003 |
| 6744 | 0 |
| 6745 | 0.007 |
| 6746 | 0.004 |
| 6747 | 0.008 |
| 6748 | 0.002 |
| 6749 | 0.001 |
| 6750 | 0.002 |
| 6751 | 0.003 |
| 6752 | 0.001 |
| 6753 | 0.002 |
| 6754 | 0.002 |
| 6755 | 0.001 |
| 6756 | 0.003 |
| 6757 | 0.004 |
| 6758 | 0.007 |
| 6759 | 0.006 |
| 6760 | 0.002 |
| 6761 | 0.008 |
| 6762 | 0.006 |
| 6763 | 0.003 |
| 6764 | 0.004 |
| 6765 | 0.007 |
| 6766 | 0.004 |
| 6767 | 0.004 |
| 6768 | 0.004 |
| 6769 | 0.002 |
| 6770 | 0.004 |
| 6771 | 0.002 |
| 6772 | 0.003 |
| 6773 | 0.002 |
| 6774 | 0.006 |
| 6775 | 0.004 |
| 6776 | 0.006 |
| 6777 | 0.001 |
| 6778 | 0.002 |
| 6779 | 0.004 |
| 6780 | 0.006 |
| 6781 | 0.002 |
| 6782 | 0.006 |
| 6783 | 0.008 |
| 6784 | 0.003 |
| 6785 | 0.003 |
| 6786 | 0.002 |
| 6787 | 0.006 |
| 6788 | 0.005 |
| 6789 | 0.004 |
| 6790 | 0.002 |
| 6791 | 0.004 |
| 6792 | 0.004 |
| 6793 | 0.003 |
| 6794 | 0.003 |
| 6795 | 0.003 |
| 6796 | 0.003 |
| 6797 | 0.002 |
| 6798 | 0.006 |
| 6799 | 0.006 |
| 6800 | 0.003 |
| 6801 | 0.003 |
| 6802 | 0.004 |
| 6803 | 0.009 |
| 6804 | 0.008 |
| 6805 | 0.003 |
| 6806 | 0.002 |
| 6807 | 0.005 |
| 6808 | 0.004 |
| 6809 | 0.005 |
| 6810 | 0.006 |
| 6811 | 0.009 |
| 6812 | 0.001 |
| 6813 | 0.005 |
| 6814 | 0.004 |
| 6815 | 0.002 |
| 6816 | 0.002 |
| 6817 | 0.006 |
| 6818 | 0.005 |
| 6819 | 0.004 |
| 6820 | 0.002 |
| 6821 | 0.002 |
| 6822 | 0.004 |
| 6823 | 0.002 |
| 6824 | 0.001 |
| 6825 | 0.003 |
| 6826 | 0.008 |
| 6827 | 0.002 |
| 6828 | 0.004 |
| 6829 | 0.002 |
| 6830 | 0.007 |
| 6831 | 0.01 |
| 6832 | 0.006 |
| 6833 | 0.007 |
| 6834 | 0.004 |
| 6835 | 0.001 |
| 6836 | 0.006 |
| 6837 | 0.005 |
| 6838 | 0.007 |
| 6839 | 0.006 |
| 6840 | 0.002 |
| 6841 | 0.004 |
| 6842 | 0.006 |
| 6843 | 0.004 |
| 6844 | 0.002 |
| 6845 | 0.002 |
| 6846 | 0.002 |
| 6847 | 0.003 |
| 6848 | 0.001 |
| 6849 | 0.004 |
| 6850 | 0.003 |
| 6851 | 0.005 |
| 6852 | 0.002 |
| 6853 | 0.004 |
| 6854 | 0.005 |
| 6855 | 0.004 |
| 6856 | 0.001 |
| 6857 | 0.003 |
| 6858 | 0.004 |
| 6859 | 0.002 |
| 6860 | 0.001 |
| 6861 | 0.002 |
| 6862 | 0.002 |
| 6863 | 0.002 |
| 6864 | 0.001 |
| 6865 | 0.003 |
| 6866 | 0.004 |
| 6867 | 0.002 |
| 6868 | 0.002 |
| 6869 | 0.003 |
| 6870 | 0.004 |
| 6871 | 0.003 |
| 6872 | 0 |
| 6873 | 0.002 |
| 6874 | 0.003 |
| 6875 | 0.007 |
| 6876 | 0.001 |
| 6877 | 0.002 |
| 6878 | 0.001 |
| 6879 | 0.005 |
| 6880 | 0.002 |
| 6881 | 0.005 |
| 6882 | 0.007 |
| 6883 | 0.012 |
| 6884 | 0.001 |
| 6885 | 0.006 |
| 6886 | 0.005 |
| 6887 | 0.001 |
| 6888 | 0.008 |
| 6889 | 0.001 |
| 6890 | 0.005 |
| 6891 | 0.002 |
| 6892 | 0.006 |
| 6893 | 0.003 |
| 6894 | 0.003 |
| 6895 | 0.002 |
| 6896 | 0.003 |
| 6897 | 0.003 |
| 6898 | 0.002 |
| 6899 | 0.003 |
| 6900 | 0.006 |
| 6901 | 0.002 |
| 6902 | 0.002 |
| 6903 | 0.003 |
| 6904 | 0.008 |
| 6905 | 0.001 |
| 6906 | 0.003 |
| 6907 | 0.004 |
| 6908 | 0.004 |
| 6909 | 0.002 |
| 6910 | 0.004 |
| 6911 | 0.006 |
| 6912 | 0.003 |
| 6913 | 0.006 |
| 6914 | 0.003 |
| 6915 | 0.003 |
| 6916 | 0.003 |
| 6917 | 0.004 |
| 6918 | 0.004 |
| 6919 | 0.006 |
| 6920 | 0.004 |
| 6921 | 0.003 |
| 6922 | 0.006 |
| 6923 | 0.005 |
| 6924 | 0.002 |
| 6925 | 0.002 |
| 6926 | 0.004 |
| 6927 | 0.003 |
| 6928 | 0.002 |
| 6929 | 0.002 |
| 6930 | 0.004 |
| 6931 | 0.003 |
| 6932 | 0.004 |
| 6933 | 0.005 |
| 6934 | 0.012 |
| 6935 | 0.006 |
| 6936 | 0.003 |
| 6937 | 0.004 |
| 6938 | 0.003 |
| 6939 | 0.004 |
| 6940 | 0.002 |
| 6941 | 0.004 |
| 6942 | 0.004 |
| 6943 | 0.006 |
| 6944 | 0.006 |
| 6945 | 0.004 |
| 6946 | 0.004 |
| 6947 | 0.008 |
| 6948 | 0.009 |
| 6949 | 0.005 |
| 6950 | 0.005 |
| 6951 | 0.004 |
| 6952 | 0.005 |
| 6953 | 0.004 |
| 6954 | 0.002 |
| 6955 | 0.005 |
| 6956 | 0.004 |
| 6957 | 0.001 |
| 6958 | 0.002 |
| 6959 | 0.003 |
| 6960 | 0.007 |
| 6961 | 0.002 |
| 6962 | 0.002 |
| 6963 | 0.002 |
| 6964 | 0.002 |
| 6965 | 0.002 |
| 6966 | 0.002 |
| 6967 | 0.005 |
| 6968 | 0.003 |
| 6969 | 0.003 |
| 6970 | 0.003 |
| 6971 | 0.004 |
| 6972 | 0.002 |
| 6973 | 0.003 |
| 6974 | 0.002 |
| 6975 | 0.003 |
| 6976 | 0.007 |
| 6977 | 0.002 |
| 6978 | 0.007 |
| 6979 | 0.006 |
| 6980 | 0.006 |
| 6981 | 0.008 |
| 6982 | 0.005 |
| 6983 | 0.005 |
| 6984 | 0.004 |
| 6985 | 0.006 |
| 6986 | 0.008 |
| 6987 | 0.001 |
| 6988 | 0.004 |
| 6989 | 0.003 |
| 6990 | 0.008 |
| 6991 | 0.008 |
| 6992 | 0.002 |
| 6993 | 0.006 |
| 6994 | 0.003 |
| 6995 | 0.004 |
| 6996 | 0.004 |
| 6997 | 0.002 |
| 6998 | 0.005 |
| 6999 | 0.003 |
| 7000 | 0.002 |
| 7001 | 0.003 |
| 7002 | 0.007 |
| 7003 | 0.005 |
| 7004 | 0.001 |
| 7005 | 0.004 |
| 7006 | 0.001 |
| 7007 | 0.004 |
| 7008 | 0.001 |
| 7009 | 0.003 |
| 7010 | 0.01 |
| 7011 | 0.003 |
| 7012 | 0.008 |
| 7013 | 0.007 |
| 7014 | 0.004 |
| 7015 | 0.004 |
| 7016 | 0.006 |
| 7017 | 0.004 |
| 7018 | 0.002 |
| 7019 | 0.002 |
| 7020 | 0.003 |
| 7021 | 0.006 |
| 7022 | 0.003 |
| 7023 | 0.003 |
| 7024 | 0.007 |
| 7025 | 0.006 |
| 7026 | 0.004 |
| 7027 | 0.005 |
| 7028 | 0.007 |
| 7029 | 0.005 |
| 7030 | 0.004 |
| 7031 | 0.005 |
| 7032 | 0.006 |
| 7033 | 0.005 |
| 7034 | 0.005 |
| 7035 | 0.003 |
| 7036 | 0.002 |
| 7037 | 0.001 |
| 7038 | 0.002 |
| 7039 | 0.009 |
| 7040 | 0.002 |
| 7041 | 0.003 |
| 7042 | 0.002 |
| 7043 | 0.008 |
| 7044 | 0.005 |
| 7045 | 0.007 |
| 7046 | 0.007 |
| 7047 | 0.004 |
| 7048 | 0.006 |
| 7049 | 0.002 |
| 7050 | 0.004 |
| 7051 | 0.003 |
| 7052 | 0.007 |
| 7053 | 0.003 |
| 7054 | 0.005 |
| 7055 | 0.008 |
| 7056 | 0.008 |
| 7057 | 0.004 |
| 7058 | 0.002 |
| 7059 | 0.004 |
| 7060 | 0.007 |
| 7061 | 0.002 |
| 7062 | 0.002 |
| 7063 | 0.003 |
| 7064 | 0.002 |
| 7065 | 0.003 |
| 7066 | 0.004 |
| 7067 | 0.004 |
| 7068 | 0.002 |
| 7069 | 0.002 |
| 7070 | 0.007 |
| 7071 | 0.006 |
| 7072 | 0.002 |
| 7073 | 0.005 |
| 7074 | 0.007 |
| 7075 | 0.003 |
| 7076 | 0.001 |
| 7077 | 0.003 |
| 7078 | 0.002 |
| 7079 | 0.006 |
| 7080 | 0.001 |
| 7081 | 0.005 |
| 7082 | 0.003 |
| 7083 | 0.005 |
| 7084 | 0.003 |
| 7085 | 0.003 |
| 7086 | 0.003 |
| 7087 | 0.004 |
| 7088 | 0.002 |
| 7089 | 0.002 |
| 7090 | 0.005 |
| 7091 | 0.007 |
| 7092 | 0.003 |
| 7093 | 0.001 |
| 7094 | 0.001 |
| 7095 | 0.006 |
| 7096 | 0.005 |
| 7097 | 0.002 |
| 7098 | 0.003 |
| 7099 | 0.006 |
| 7100 | 0.001 |
| 7101 | 0.004 |
| 7102 | 0.004 |
| 7103 | 0.008 |
| 7104 | 0.003 |
| 7105 | 0.003 |
| 7106 | 0.01 |
| 7107 | 0.006 |
| 7108 | 0.004 |
| 7109 | 0.003 |
| 7110 | 0.005 |
| 7111 | 0.001 |
| 7112 | 0.003 |
| 7113 | 0.001 |
| 7114 | 0.006 |
| 7115 | 0.005 |
| 7116 | 0.003 |
| 7117 | 0.003 |
| 7118 | 0.005 |
| 7119 | 0.007 |
| 7120 | 0.003 |
| 7121 | 0.005 |
| 7122 | 0.006 |
| 7123 | 0.005 |
| 7124 | 0.002 |
| 7125 | 0.003 |
| 7126 | 0.003 |
| 7127 | 0.001 |
| 7128 | 0.002 |
| 7129 | 0.006 |
| 7130 | 0.006 |
| 7131 | 0.002 |
| 7132 | 0.003 |
| 7133 | 0.006 |
| 7134 | 0.006 |
| 7135 | 0.005 |
| 7136 | 0.001 |
| 7137 | 0.006 |
| 7138 | 0.006 |
| 7139 | 0.006 |
| 7140 | 0.003 |
| 7141 | 0.002 |
| 7142 | 0.003 |
| 7143 | 0.003 |
| 7144 | 0.005 |
| 7145 | 0.004 |
| 7146 | 0.01 |
| 7147 | 0.003 |
| 7148 | 0.002 |
| 7149 | 0.004 |
| 7150 | 0.003 |
| 7151 | 0.007 |
| 7152 | 0.002 |
| 7153 | 0.004 |
| 7154 | 0.002 |
| 7155 | 0.006 |
| 7156 | 0.006 |
| 7157 | 0.005 |
| 7158 | 0.006 |
| 7159 | 0.007 |
| 7160 | 0.004 |
| 7161 | 0.003 |
| 7162 | 0.001 |
| 7163 | 0.005 |
| 7164 | 0.004 |
| 7165 | 0.002 |
| 7166 | 0.004 |
| 7167 | 0.003 |
| 7168 | 0.002 |
| 7169 | 0.002 |
| 7170 | 0.006 |
| 7171 | 0.002 |
| 7172 | 0.006 |
| 7173 | 0.005 |
| 7174 | 0.008 |
| 7175 | 0.005 |
| 7176 | 0.001 |
| 7177 | 0.003 |
| 7178 | 0.008 |
| 7179 | 0.003 |
| 7180 | 0.004 |
| 7181 | 0.004 |
| 7182 | 0.004 |
| 7183 | 0.007 |
| 7184 | 0.001 |
| 7185 | 0.004 |
| 7186 | 0.005 |
| 7187 | 0.006 |
| 7188 | 0.003 |
| 7189 | 0.003 |
| 7190 | 0.006 |
| 7191 | 0.008 |
| 7192 | 0.002 |
| 7193 | 0.002 |
| 7194 | 0.001 |
| 7195 | 0.004 |
| 7196 | 0.001 |
| 7197 | 0.001 |
| 7198 | 0.007 |
| 7199 | 0.005 |
| 7200 | 0.002 |
| 7201 | 0.003 |
| 7202 | 0.005 |
| 7203 | 0.008 |
| 7204 | 0.014 |
| 7205 | 0.005 |
| 7206 | 0.002 |
| 7207 | 0.003 |
| 7208 | 0.005 |
| 7209 | 0.004 |
| 7210 | 0.003 |
| 7211 | 0.007 |
| 7212 | 0.004 |
| 7213 | 0.003 |
| 7214 | 0.005 |
| 7215 | 0.003 |
| 7216 | 0.003 |
| 7217 | 0.002 |
| 7218 | 0.006 |
| 7219 | 0.008 |
| 7220 | 0.01 |
| 7221 | 0.003 |
| 7222 | 0.005 |
| 7223 | 0.005 |
| 7224 | 0.007 |
| 7225 | 0.002 |
| 7226 | 0.006 |
| 7227 | 0.003 |
| 7228 | 0.003 |
| 7229 | 0.001 |
| 7230 | 0.005 |
| 7231 | 0.002 |
| 7232 | 0.006 |
| 7233 | 0.002 |
| 7234 | 0.001 |
| 7235 | 0.005 |
| 7236 | 0.007 |
| 7237 | 0.001 |
| 7238 | 0.003 |
| 7239 | 0.005 |
| 7240 | 0.001 |
| 7241 | 0.002 |
| 7242 | 0.007 |
| 7243 | 0.01 |
| 7244 | 0.003 |
| 7245 | 0.004 |
| 7246 | 0.004 |
| 7247 | 0.002 |
| 7248 | 0.004 |
| 7249 | 0.002 |
| 7250 | 0.006 |
| 7251 | 0.01 |
| 7252 | 0.003 |
| 7253 | 0.004 |
| 7254 | 0.009 |
| 7255 | 0.007 |
| 7256 | 0.002 |
| 7257 | 0.001 |
| 7258 | 0.007 |
| 7259 | 0.009 |
| 7260 | 0.01 |
| 7261 | 0.01 |
| 7262 | 0.002 |
| 7263 | 0.003 |
| 7264 | 0.002 |
| 7265 | 0.002 |
| 7266 | 0.005 |
| 7267 | 0.005 |
| 7268 | 0.002 |
| 7269 | 0.003 |
| 7270 | 0.004 |
| 7271 | 0.001 |
| 7272 | 0.004 |
| 7273 | 0.003 |
| 7274 | 0.004 |
| 7275 | 0.007 |
| 7276 | 0.002 |
| 7277 | 0.001 |
| 7278 | 0.002 |
| 7279 | 0.001 |
| 7280 | 0.003 |
| 7281 | 0.006 |
| 7282 | 0.008 |
| 7283 | 0.005 |
| 7284 | 0.001 |
| 7285 | 0.003 |
| 7286 | 0.007 |
| 7287 | 0.007 |
| 7288 | 0.003 |
| 7289 | 0.003 |
| 7290 | 0.002 |
| 7291 | 0.003 |
| 7292 | 0.003 |
| 7293 | 0.004 |
| 7294 | 0.007 |
| 7295 | 0.003 |
| 7296 | 0.005 |
| 7297 | 0.008 |
| 7298 | 0.002 |
| 7299 | 0.003 |
| 7300 | 0.005 |
| 7301 | 0.003 |
| 7302 | 0.006 |
| 7303 | 0.002 |
| 7304 | 0.004 |
| 7305 | 0.003 |
| 7306 | 0.007 |
| 7307 | 0.003 |
| 7308 | 0.003 |
| 7309 | 0.006 |
| 7310 | 0.002 |
| 7311 | 0.001 |
| 7312 | 0.004 |
| 7313 | 0.005 |
| 7314 | 0.004 |
| 7315 | 0.002 |
| 7316 | 0.001 |
| 7317 | 0.007 |
| 7318 | 0.001 |
| 7319 | 0.006 |
| 7320 | 0.004 |
| 7321 | 0.005 |
| 7322 | 0.002 |
| 7323 | 0.006 |
| 7324 | 0.005 |
| 7325 | 0.004 |
| 7326 | 0.003 |
| 7327 | 0.006 |
| 7328 | 0.004 |
| 7329 | 0.002 |
| 7330 | 0.002 |
| 7331 | 0.007 |
| 7332 | 0.007 |
| 7333 | 0.005 |
| 7334 | 0.006 |
| 7335 | 0.006 |
| 7336 | 0.006 |
| 7337 | 0.003 |
| 7338 | 0.003 |
| 7339 | 0.005 |
| 7340 | 0.003 |
| 7341 | 0.003 |
| 7342 | 0.004 |
| 7343 | 0.003 |
| 7344 | 0.003 |
| 7345 | 0.007 |
| 7346 | 0.005 |
| 7347 | 0.004 |
| 7348 | 0.003 |
| 7349 | 0.002 |
| 7350 | 0.003 |
| 7351 | 0.002 |
| 7352 | 0.004 |
| 7353 | 0.003 |
| 7354 | 0.004 |
| 7355 | 0.006 |
| 7356 | 0.007 |
| 7357 | 0.011 |
| 7358 | 0.006 |
| 7359 | 0.006 |
| 7360 | 0.001 |
| 7361 | 0.001 |
| 7362 | 0.006 |
| 7363 | 0.003 |
| 7364 | 0.004 |
| 7365 | 0.001 |
| 7366 | 0.004 |
| 7367 | 0.004 |
| 7368 | 0.002 |
| 7369 | 0.003 |
| 7370 | 0.004 |
| 7371 | 0.002 |
| 7372 | 0.006 |
| 7373 | 0.001 |
| 7374 | 0.002 |
| 7375 | 0.005 |
| 7376 | 0.002 |
| 7377 | 0 |
| 7378 | 0.002 |
| 7379 | 0.01 |
| 7380 | 0.006 |
| 7381 | 0.003 |
| 7382 | 0.001 |
| 7383 | 0.007 |
| 7384 | 0.008 |
| 7385 | 0.002 |
| 7386 | 0.004 |
| 7387 | 0.003 |
| 7388 | 0.002 |
| 7389 | 0.004 |
| 7390 | 0.006 |
| 7391 | 0.003 |
| 7392 | 0.001 |
| 7393 | 0.002 |
| 7394 | 0.009 |
| 7395 | 0.007 |
| 7396 | 0.004 |
| 7397 | 0.005 |
| 7398 | 0.004 |
| 7399 | 0.004 |
| 7400 | 0.001 |
| 7401 | 0.005 |
| 7402 | 0.003 |
| 7403 | 0.005 |
| 7404 | 0.002 |
| 7405 | 0.002 |
| 7406 | 0.005 |
| 7407 | 0.005 |
| 7408 | 0.003 |
| 7409 | 0.006 |
| 7410 | 0.006 |
| 7411 | 0.005 |
| 7412 | 0.002 |
| 7413 | 0.002 |
| 7414 | 0.003 |
| 7415 | 0.009 |
| 7416 | 0.003 |
| 7417 | 0.004 |
| 7418 | 0.006 |
| 7419 | 0.007 |
| 7420 | 0.003 |
| 7421 | 0.005 |
| 7422 | 0.005 |
| 7423 | 0.005 |
| 7424 | 0.004 |
| 7425 | 0.004 |
| 7426 | 0.004 |
| 7427 | 0.006 |
| 7428 | 0.002 |
| 7429 | 0.002 |
| 7430 | 0.001 |
| 7431 | 0.001 |
| 7432 | 0.008 |
| 7433 | 0.004 |
| 7434 | 0.004 |
| 7435 | 0.005 |
| 7436 | 0.003 |
| 7437 | 0.002 |
| 7438 | 0.004 |
| 7439 | 0.003 |
| 7440 | 0.002 |
| 7441 | 0.003 |
| 7442 | 0.006 |
| 7443 | 0.007 |
| 7444 | 0.002 |
| 7445 | 0.002 |
| 7446 | 0.004 |
| 7447 | 0.005 |
| 7448 | 0.001 |
| 7449 | 0.003 |
| 7450 | 0.002 |
| 7451 | 0.001 |
| 7452 | 0.005 |
| 7453 | 0.003 |
| 7454 | 0.004 |
| 7455 | 0.006 |
| 7456 | 0.002 |
| 7457 | 0.003 |
| 7458 | 0.003 |
| 7459 | 0.007 |
| 7460 | 0.003 |
| 7461 | 0.007 |
| 7462 | 0.006 |
| 7463 | 0.009 |
| 7464 | 0.002 |
| 7465 | 0.002 |
| 7466 | 0.005 |
| 7467 | 0.008 |
| 7468 | 0.004 |
| 7469 | 0.004 |
| 7470 | 0.009 |
| 7471 | 0.004 |
| 7472 | 0.001 |
| 7473 | 0.002 |
| 7474 | 0.003 |
| 7475 | 0.003 |
| 7476 | 0.002 |
| 7477 | 0.003 |
| 7478 | 0.004 |
| 7479 | 0.007 |
| 7480 | 0.004 |
| 7481 | 0.006 |
| 7482 | 0.005 |
| 7483 | 0.009 |
| 7484 | 0.004 |
| 7485 | 0.004 |
| 7486 | 0.005 |
| 7487 | 0.002 |
| 7488 | 0.001 |
| 7489 | 0.002 |
| 7490 | 0.003 |
| 7491 | 0.001 |
| 7492 | 0.006 |
| 7493 | 0.001 |
| 7494 | 0.007 |
| 7495 | 0.01 |
| 7496 | 0.007 |
| 7497 | 0.004 |
| 7498 | 0.001 |
| 7499 | 0.006 |
| 7500 | 0.003 |
| 7501 | 0.003 |
| 7502 | 0.003 |
| 7503 | 0.003 |
| 7504 | 0.012 |
| 7505 | 0.004 |
| 7506 | 0.003 |
| 7507 | 0.003 |
| 7508 | 0.004 |
| 7509 | 0.001 |
| 7510 | 0.002 |
| 7511 | 0.004 |
| 7512 | 0.002 |
| 7513 | 0.001 |
| 7514 | 0.005 |
| 7515 | 0.007 |
| 7516 | 0.004 |
| 7517 | 0.003 |
| 7518 | 0.002 |
| 7519 | 0.005 |
| 7520 | 0.007 |
| 7521 | 0.003 |
| 7522 | 0.003 |
| 7523 | 0.002 |
| 7524 | 0.003 |
| 7525 | 0.007 |
| 7526 | 0.004 |
| 7527 | 0.006 |
| 7528 | 0.002 |
| 7529 | 0.004 |
| 7530 | 0.005 |
| 7531 | 0.004 |
| 7532 | 0.001 |
| 7533 | 0.003 |
| 7534 | 0.002 |
| 7535 | 0.004 |
| 7536 | 0.001 |
| 7537 | 0.002 |
| 7538 | 0.001 |
| 7539 | 0.002 |
| 7540 | 0.002 |
| 7541 | 0.004 |
| 7542 | 0.004 |
| 7543 | 0.005 |
| 7544 | 0.003 |
| 7545 | 0.005 |
| 7546 | 0.001 |
| 7547 | 0.005 |
| 7548 | 0.005 |
| 7549 | 0.004 |
| 7550 | 0.009 |
| 7551 | 0.006 |
| 7552 | 0.003 |
| 7553 | 0.002 |
| 7554 | 0.004 |
| 7555 | 0.004 |
| 7556 | 0.002 |
| 7557 | 0.004 |
| 7558 | 0.006 |
| 7559 | 0.004 |
| 7560 | 0.001 |
| 7561 | 0.001 |
| 7562 | 0.008 |
| 7563 | 0.009 |
| 7564 | 0.003 |
| 7565 | 0.001 |
| 7566 | 0.008 |
| 7567 | 0.012 |
| 7568 | 0.002 |
| 7569 | 0.002 |
| 7570 | 0.01 |
| 7571 | 0.005 |
| 7572 | 0.009 |
| 7573 | 0.004 |
| 7574 | 0.004 |
| 7575 | 0.006 |
| 7576 | 0.007 |
| 7577 | 0.002 |
| 7578 | 0.003 |
| 7579 | 0.004 |
| 7580 | 0.003 |
| 7581 | 0.003 |
| 7582 | 0.002 |
| 7583 | 0.005 |
| 7584 | 0.005 |
| 7585 | 0.003 |
| 7586 | 0.005 |
| 7587 | 0.006 |
| 7588 | 0.001 |
| 7589 | 0.003 |
| 7590 | 0.003 |
| 7591 | 0.004 |
| 7592 | 0.002 |
| 7593 | 0.004 |
| 7594 | 0.006 |
| 7595 | 0.003 |
| 7596 | 0.004 |
| 7597 | 0.002 |
| 7598 | 0.003 |
| 7599 | 0.001 |
| 7600 | 0.002 |
| 7601 | 0.01 |
| 7602 | 0.004 |
| 7603 | 0.009 |
| 7604 | 0.002 |
| 7605 | 0.005 |
| 7606 | 0.004 |
| 7607 | 0.001 |
| 7608 | 0.002 |
| 7609 | 0.004 |
| 7610 | 0.002 |
| 7611 | 0.006 |
| 7612 | 0.007 |
| 7613 | 0.004 |
| 7614 | 0.001 |
| 7615 | 0.004 |
| 7616 | 0.008 |
| 7617 | 0.007 |
| 7618 | 0.003 |
| 7619 | 0.002 |
| 7620 | 0.001 |
| 7621 | 0.002 |
| 7622 | 0.007 |
| 7623 | 0.003 |
| 7624 | 0.004 |
| 7625 | 0.005 |
| 7626 | 0.003 |
| 7627 | 0.007 |
| 7628 | 0.003 |
| 7629 | 0.007 |
| 7630 | 0.003 |
| 7631 | 0.002 |
| 7632 | 0.003 |
| 7633 | 0.006 |
| 7634 | 0.008 |
| 7635 | 0.002 |
| 7636 | 0.007 |
| 7637 | 0.008 |
| 7638 | 0.007 |
| 7639 | 0.011 |
| 7640 | 0.006 |
| 7641 | 0.003 |
| 7642 | 0.003 |
| 7643 | 0.003 |
| 7644 | 0.006 |
| 7645 | 0.004 |
| 7646 | 0.003 |
| 7647 | 0.004 |
| 7648 | 0.002 |
| 7649 | 0.003 |
| 7650 | 0.007 |
| 7651 | 0.005 |
| 7652 | 0.007 |
| 7653 | 0.006 |
| 7654 | 0.005 |
| 7655 | 0.003 |
| 7656 | 0.005 |
| 7657 | 0.005 |
| 7658 | 0.005 |
| 7659 | 0.005 |
| 7660 | 0.004 |
| 7661 | 0.005 |
| 7662 | 0.002 |
| 7663 | 0.005 |
| 7664 | 0.005 |
| 7665 | 0.004 |
| 7666 | 0.002 |
| 7667 | 0.003 |
| 7668 | 0.001 |
| 7669 | 0.002 |
| 7670 | 0.003 |
| 7671 | 0.008 |
| 7672 | 0.002 |
| 7673 | 0.004 |
| 7674 | 0.006 |
| 7675 | 0.01 |
| 7676 | 0.006 |
| 7677 | 0.005 |
| 7678 | 0.008 |
| 7679 | 0.005 |
| 7680 | 0.004 |
| 7681 | 0.002 |
| 7682 | 0.006 |
| 7683 | 0.009 |
| 7684 | 0.001 |
| 7685 | 0.001 |
| 7686 | 0.007 |
| 7687 | 0.004 |
| 7688 | 0.003 |
| 7689 | 0.002 |
| 7690 | 0.001 |
| 7691 | 0.006 |
| 7692 | 0.004 |
| 7693 | 0.003 |
| 7694 | 0.004 |
| 7695 | 0.005 |
| 7696 | 0.004 |
| 7697 | 0.003 |
| 7698 | 0.003 |
| 7699 | 0.003 |
| 7700 | 0.008 |
| 7701 | 0.001 |
| 7702 | 0.001 |
| 7703 | 0.003 |
| 7704 | 0.004 |
| 7705 | 0.006 |
| 7706 | 0.002 |
| 7707 | 0.004 |
| 7708 | 0.003 |
| 7709 | 0.002 |
| 7710 | 0.004 |
| 7711 | 0.006 |
| 7712 | 0.007 |
| 7713 | 0.002 |
| 7714 | 0.004 |
| 7715 | 0.006 |
| 7716 | 0.001 |
| 7717 | 0.001 |
| 7718 | 0.004 |
| 7719 | 0.005 |
| 7720 | 0.004 |
| 7721 | 0.003 |
| 7722 | 0.002 |
| 7723 | 0.005 |
| 7724 | 0.01 |
| 7725 | 0.001 |
| 7726 | 0.002 |
| 7727 | 0.001 |
| 7728 | 0.003 |
| 7729 | 0.003 |
| 7730 | 0.007 |
| 7731 | 0.008 |
| 7732 | 0.003 |
| 7733 | 0.003 |
| 7734 | 0.005 |
| 7735 | 0.004 |
| 7736 | 0.004 |
| 7737 | 0.004 |
| 7738 | 0.005 |
| 7739 | 0.004 |
| 7740 | 0.003 |
| 7741 | 0.006 |
| 7742 | 0.011 |
| 7743 | 0.003 |
| 7744 | 0.002 |
| 7745 | 0.004 |
| 7746 | 0.004 |
| 7747 | 0.003 |
| 7748 | 0.004 |
| 7749 | 0.002 |
| 7750 | 0.007 |
| 7751 | 0.005 |
| 7752 | 0.002 |
| 7753 | 0.006 |
| 7754 | 0.005 |
| 7755 | 0.011 |
| 7756 | 0.004 |
| 7757 | 0.002 |
| 7758 | 0.009 |
| 7759 | 0.005 |
| 7760 | 0.004 |
| 7761 | 0.003 |
| 7762 | 0.005 |
| 7763 | 0.004 |
| 7764 | 0.002 |
| 7765 | 0.003 |
| 7766 | 0.008 |
| 7767 | 0.009 |
| 7768 | 0.002 |
| 7769 | 0.003 |
| 7770 | 0.008 |
| 7771 | 0.006 |
| 7772 | 0.001 |
| 7773 | 0.001 |
| 7774 | 0.006 |
| 7775 | 0.004 |
| 7776 | 0.006 |
| 7777 | 0.003 |
| 7778 | 0.002 |
| 7779 | 0.002 |
| 7780 | 0.005 |
| 7781 | 0.004 |
| 7782 | 0.003 |
| 7783 | 0.005 |
| 7784 | 0.003 |
| 7785 | 0.001 |
| 7786 | 0.004 |
| 7787 | 0.005 |
| 7788 | 0.006 |
| 7789 | 0.004 |
| 7790 | 0.004 |
| 7791 | 0.006 |
| 7792 | 0.003 |
| 7793 | 0.003 |
| 7794 | 0.005 |
| 7795 | 0.013 |
| 7796 | 0.007 |
| 7797 | 0.003 |
| 7798 | 0.007 |
| 7799 | 0.007 |
| 7800 | 0.003 |
| 7801 | 0.002 |
| 7802 | 0.007 |
| 7803 | 0.006 |
| 7804 | 0.011 |
| 7805 | 0.006 |
| 7806 | 0.007 |
| 7807 | 0.005 |
| 7808 | 0.002 |
| 7809 | 0.001 |
| 7810 | 0.005 |
| 7811 | 0.01 |
| 7812 | 0.002 |
| 7813 | 0.002 |
| 7814 | 0.005 |
| 7815 | 0.006 |
| 7816 | 0.001 |
| 7817 | 0.007 |
| 7818 | 0.006 |
| 7819 | 0.006 |
| 7820 | 0.002 |
| 7821 | 0.006 |
| 7822 | 0.007 |
| 7823 | 0.006 |
| 7824 | 0.002 |
| 7825 | 0.005 |
| 7826 | 0.007 |
| 7827 | 0.007 |
| 7828 | 0.004 |
| 7829 | 0.004 |
| 7830 | 0.004 |
| 7831 | 0.003 |
| 7832 | 0.007 |
| 7833 | 0.005 |
| 7834 | 0.003 |
| 7835 | 0.006 |
| 7836 | 0.001 |
| 7837 | 0.002 |
| 7838 | 0.003 |
| 7839 | 0.003 |
| 7840 | 0.003 |
| 7841 | 0.003 |
| 7842 | 0.004 |
| 7843 | 0.007 |
| 7844 | 0.001 |
| 7845 | 0.002 |
| 7846 | 0.002 |
| 7847 | 0.006 |
| 7848 | 0.003 |
| 7849 | 0.005 |
| 7850 | 0.008 |
| 7851 | 0.006 |
| 7852 | 0.004 |
| 7853 | 0.008 |
| 7854 | 0.003 |
| 7855 | 0.002 |
| 7856 | 0.002 |
| 7857 | 0.002 |
| 7858 | 0.006 |
| 7859 | 0.002 |
| 7860 | 0.004 |
| 7861 | 0.005 |
| 7862 | 0.004 |
| 7863 | 0.003 |
| 7864 | 0.005 |
| 7865 | 0.004 |
| 7866 | 0.002 |
| 7867 | 0.005 |
| 7868 | 0.006 |
| 7869 | 0.003 |
| 7870 | 0.003 |
| 7871 | 0.006 |
| 7872 | 0.002 |
| 7873 | 0.002 |
| 7874 | 0.003 |
| 7875 | 0.007 |
| 7876 | 0.002 |
| 7877 | 0.002 |
| 7878 | 0.004 |
| 7879 | 0.006 |
| 7880 | 0.002 |
| 7881 | 0.004 |
| 7882 | 0.002 |
| 7883 | 0.001 |
| 7884 | 0.006 |
| 7885 | 0.004 |
| 7886 | 0.006 |
| 7887 | 0.002 |
| 7888 | 0.006 |
| 7889 | 0.006 |
| 7890 | 0.001 |
| 7891 | 0 |
| 7892 | 0.002 |
| 7893 | 0.004 |
| 7894 | 0.008 |
| 7895 | 0.008 |
| 7896 | 0.005 |
| 7897 | 0.007 |
| 7898 | 0.007 |
| 7899 | 0.007 |
| 7900 | 0.005 |
| 7901 | 0.003 |
| 7902 | 0.002 |
| 7903 | 0.006 |
| 7904 | 0.005 |
| 7905 | 0.003 |
| 7906 | 0.006 |
| 7907 | 0.005 |
| 7908 | 0.002 |
| 7909 | 0.005 |
| 7910 | 0.005 |
| 7911 | 0.003 |
| 7912 | 0.004 |
| 7913 | 0.004 |
| 7914 | 0.004 |
| 7915 | 0.003 |
| 7916 | 0.004 |
| 7917 | 0.003 |
| 7918 | 0.007 |
| 7919 | 0.003 |
| 7920 | 0.002 |
| 7921 | 0.002 |
| 7922 | 0.005 |
| 7923 | 0.004 |
| 7924 | 0.005 |
| 7925 | 0.006 |
| 7926 | 0.004 |
| 7927 | 0.006 |
| 7928 | 0.002 |
| 7929 | 0.002 |
| 7930 | 0.008 |
| 7931 | 0.008 |
| 7932 | 0.007 |
| 7933 | 0.007 |
| 7934 | 0.004 |
| 7935 | 0.009 |
| 7936 | 0.004 |
| 7937 | 0.004 |
| 7938 | 0.004 |
| 7939 | 0.002 |
| 7940 | 0.005 |
| 7941 | 0.003 |
| 7942 | 0.004 |
| 7943 | 0.007 |
| 7944 | 0.002 |
| 7945 | 0.002 |
| 7946 | 0.007 |
| 7947 | 0.006 |
| 7948 | 0.007 |
| 7949 | 0.005 |
| 7950 | 0.004 |
| 7951 | 0.004 |
| 7952 | 0.002 |
| 7953 | 0.005 |
| 7954 | 0.005 |
| 7955 | 0.003 |
| 7956 | 0.006 |
| 7957 | 0.008 |
| 7958 | 0.008 |
| 7959 | 0.005 |
| 7960 | 0.005 |
| 7961 | 0.004 |
| 7962 | 0.005 |
| 7963 | 0.004 |
| 7964 | 0.002 |
| 7965 | 0.004 |
| 7966 | 0.001 |
| 7967 | 0.006 |
| 7968 | 0.003 |
| 7969 | 0.002 |
| 7970 | 0.004 |
| 7971 | 0.007 |
| 7972 | 0.002 |
| 7973 | 0.005 |
| 7974 | 0.003 |
| 7975 | 0.006 |
| 7976 | 0.004 |
| 7977 | 0.008 |
| 7978 | 0.003 |
| 7979 | 0.006 |
| 7980 | 0.003 |
| 7981 | 0.002 |
| 7982 | 0.009 |
| 7983 | 0.009 |
| 7984 | 0.002 |
| 7985 | 0.006 |
| 7986 | 0.006 |
| 7987 | 0.005 |
| 7988 | 0.002 |
| 7989 | 0.002 |
| 7990 | 0.002 |
| 7991 | 0.008 |
| 7992 | 0.001 |
| 7993 | 0.004 |
| 7994 | 0.011 |
| 7995 | 0.002 |
| 7996 | 0.004 |
| 7997 | 0.003 |
| 7998 | 0.003 |
| 7999 | 0.003 |
| 8000 | 0.002 |
| 8001 | 0.002 |
| 8002 | 0.005 |
| 8003 | 0.003 |
| 8004 | 0.004 |
| 8005 | 0.006 |
| 8006 | 0.006 |
| 8007 | 0.004 |
| 8008 | 0.002 |
| 8009 | 0.002 |
| 8010 | 0.004 |
| 8011 | 0.007 |
| 8012 | 0.002 |
| 8013 | 0.005 |
| 8014 | 0.004 |
| 8015 | 0.009 |
| 8016 | 0.004 |
| 8017 | 0.005 |
| 8018 | 0.007 |
| 8019 | 0.003 |
| 8020 | 0.001 |
| 8021 | 0.004 |
| 8022 | 0.006 |
| 8023 | 0.007 |
| 8024 | 0.005 |
| 8025 | 0.005 |
| 8026 | 0.008 |
| 8027 | 0.008 |
| 8028 | 0.003 |
| 8029 | 0.005 |
| 8030 | 0.005 |
| 8031 | 0.004 |
| 8032 | 0.003 |
| 8033 | 0.004 |
| 8034 | 0.004 |
| 8035 | 0.008 |
| 8036 | 0 |
| 8037 | 0.001 |
| 8038 | 0.005 |
| 8039 | 0.004 |
| 8040 | 0.002 |
| 8041 | 0.003 |
| 8042 | 0.002 |
| 8043 | 0.004 |
| 8044 | 0.002 |
| 8045 | 0.001 |
| 8046 | 0.004 |
| 8047 | 0.003 |
| 8048 | 0.006 |
| 8049 | 0.002 |
| 8050 | 0.003 |
| 8051 | 0.007 |
| 8052 | 0.002 |
| 8053 | 0.001 |
| 8054 | 0.005 |
| 8055 | 0.003 |
| 8056 | 0.004 |
| 8057 | 0.001 |
| 8058 | 0.008 |
| 8059 | 0.004 |
| 8060 | 0.002 |
| 8061 | 0.004 |
| 8062 | 0.007 |
| 8063 | 0.012 |
| 8064 | 0.007 |
| 8065 | 0.005 |
| 8066 | 0.003 |
| 8067 | 0.006 |
| 8068 | 0.005 |
| 8069 | 0.003 |
| 8070 | 0.002 |
| 8071 | 0.004 |
| 8072 | 0.006 |
| 8073 | 0.005 |
| 8074 | 0.008 |
| 8075 | 0.007 |
| 8076 | 0.004 |
| 8077 | 0.003 |
| 8078 | 0.008 |
| 8079 | 0.007 |
| 8080 | 0.005 |
| 8081 | 0.004 |
| 8082 | 0.011 |
| 8083 | 0.006 |
| 8084 | 0.002 |
| 8085 | 0.001 |
| 8086 | 0.003 |
| 8087 | 0.004 |
| 8088 | 0.002 |
| 8089 | 0.003 |
| 8090 | 0.004 |
| 8091 | 0.004 |
| 8092 | 0.004 |
| 8093 | 0.003 |
| 8094 | 0.003 |
| 8095 | 0.006 |
| 8096 | 0.003 |
| 8097 | 0.003 |
| 8098 | 0.008 |
| 8099 | 0.003 |
| 8100 | 0.004 |
| 8101 | 0.003 |
| 8102 | 0.004 |
| 8103 | 0.008 |
| 8104 | 0.002 |
| 8105 | 0.001 |
| 8106 | 0.005 |
| 8107 | 0.005 |
| 8108 | 0.001 |
| 8109 | 0.004 |
| 8110 | 0.011 |
| 8111 | 0.006 |
| 8112 | 0.004 |
| 8113 | 0.006 |
| 8114 | 0.003 |
| 8115 | 0.002 |
| 8116 | 0.003 |
| 8117 | 0.005 |
| 8118 | 0.003 |
| 8119 | 0.011 |
| 8120 | 0.009 |
| 8121 | 0.011 |
| 8122 | 0.006 |
| 8123 | 0.013 |
| 8124 | 0.004 |
| 8125 | 0.003 |
| 8126 | 0.006 |
| 8127 | 0.002 |
| 8128 | 0.001 |
| 8129 | 0.002 |
| 8130 | 0.005 |
| 8131 | 0.004 |
| 8132 | 0.001 |
| 8133 | 0.002 |
| 8134 | 0.004 |
| 8135 | 0.003 |
| 8136 | 0.001 |
| 8137 | 0.004 |
| 8138 | 0.009 |
| 8139 | 0.004 |
| 8140 | 0.006 |
| 8141 | 0.004 |
| 8142 | 0.004 |
| 8143 | 0.002 |
| 8144 | 0.008 |
| 8145 | 0.003 |
| 8146 | 0.001 |
| 8147 | 0.003 |
| 8148 | 0.003 |
| 8149 | 0.006 |
| 8150 | 0.004 |
| 8151 | 0.008 |
| 8152 | 0.006 |
| 8153 | 0.005 |
| 8154 | 0.006 |
| 8155 | 0.004 |
| 8156 | 0.005 |
| 8157 | 0.001 |
| 8158 | 0.006 |
| 8159 | 0.001 |
| 8160 | 0.009 |
| 8161 | 0.003 |
| 8162 | 0.003 |
| 8163 | 0.001 |
| 8164 | 0.001 |
| 8165 | 0.004 |
| 8166 | 0.002 |
| 8167 | 0.003 |
| 8168 | 0.003 |
| 8169 | 0.001 |
| 8170 | 0.002 |
| 8171 | 0.003 |
| 8172 | 0.007 |
| 8173 | 0.002 |
| 8174 | 0.006 |
| 8175 | 0.002 |
| 8176 | 0.009 |
| 8177 | 0.006 |
| 8178 | 0.001 |
| 8179 | 0.006 |
| 8180 | 0.004 |
| 8181 | 0.006 |
| 8182 | 0.007 |
| 8183 | 0.006 |
| 8184 | 0.007 |
| 8185 | 0.003 |
| 8186 | 0.003 |
| 8187 | 0.003 |
| 8188 | 0.004 |
| 8189 | 0.005 |
| 8190 | 0.006 |
| 8191 | 0.006 |
| 8192 | 0.003 |
| 8193 | 0.004 |
| 8194 | 0.006 |
| 8195 | 0.006 |
| 8196 | 0.008 |
| 8197 | 0.004 |
| 8198 | 0.005 |
| 8199 | 0.005 |
| 8200 | 0.007 |
| 8201 | 0.005 |
| 8202 | 0.01 |
| 8203 | 0.007 |
| 8204 | 0.005 |
| 8205 | 0.004 |
| 8206 | 0.003 |
| 8207 | 0.007 |
| 8208 | 0.003 |
| 8209 | 0.002 |
| 8210 | 0.004 |
| 8211 | 0.003 |
| 8212 | 0.004 |
| 8213 | 0.006 |
| 8214 | 0.008 |
| 8215 | 0.003 |
| 8216 | 0.01 |
| 8217 | 0.006 |
| 8218 | 0.003 |
| 8219 | 0.002 |
| 8220 | 0.008 |
| 8221 | 0.009 |
| 8222 | 0.003 |
| 8223 | 0.002 |
| 8224 | 0.005 |
| 8225 | 0.003 |
| 8226 | 0.006 |
| 8227 | 0.013 |
| 8228 | 0.002 |
| 8229 | 0.003 |
| 8230 | 0.005 |
| 8231 | 0.003 |
| 8232 | 0.004 |
| 8233 | 0.002 |
| 8234 | 0.007 |
| 8235 | 0.007 |
| 8236 | 0.004 |
| 8237 | 0.005 |
| 8238 | 0.005 |
| 8239 | 0.007 |
| 8240 | 0.002 |
| 8241 | 0.003 |
| 8242 | 0.003 |
| 8243 | 0.004 |
| 8244 | 0.003 |
| 8245 | 0.006 |
| 8246 | 0.004 |
| 8247 | 0.002 |
| 8248 | 0.005 |
| 8249 | 0.003 |
| 8250 | 0.003 |
| 8251 | 0.005 |
| 8252 | 0.003 |
| 8253 | 0.004 |
| 8254 | 0.002 |
| 8255 | 0.007 |
| 8256 | 0.001 |
| 8257 | 0.003 |
| 8258 | 0.005 |
| 8259 | 0.005 |
| 8260 | 0.003 |
| 8261 | 0.002 |
| 8262 | 0.007 |
| 8263 | 0.006 |
| 8264 | 0.003 |
| 8265 | 0.005 |
| 8266 | 0.004 |
| 8267 | 0.005 |
| 8268 | 0.004 |
| 8269 | 0.004 |
| 8270 | 0.008 |
| 8271 | 0.006 |
| 8272 | 0.003 |
| 8273 | 0.002 |
| 8274 | 0.007 |
| 8275 | 0.003 |
| 8276 | 0.005 |
| 8277 | 0.004 |
| 8278 | 0.005 |
| 8279 | 0.003 |
| 8280 | 0.002 |
| 8281 | 0.004 |
| 8282 | 0.007 |
| 8283 | 0.005 |
| 8284 | 0.002 |
| 8285 | 0.002 |
| 8286 | 0.007 |
| 8287 | 0.008 |
| 8288 | 0.005 |
| 8289 | 0.002 |
| 8290 | 0.003 |
| 8291 | 0.008 |
| 8292 | 0.002 |
| 8293 | 0.001 |
| 8294 | 0.002 |
| 8295 | 0.002 |
| 8296 | 0.003 |
| 8297 | 0.004 |
| 8298 | 0.006 |
| 8299 | 0.006 |
| 8300 | 0.003 |
| 8301 | 0.001 |
| 8302 | 0.001 |
| 8303 | 0.002 |
| 8304 | 0.002 |
| 8305 | 0.005 |
| 8306 | 0.002 |
| 8307 | 0.004 |
| 8308 | 0.002 |
| 8309 | 0.002 |
| 8310 | 0.003 |
| 8311 | 0.007 |
| 8312 | 0.003 |
| 8313 | 0.005 |
| 8314 | 0.005 |
| 8315 | 0.007 |
| 8316 | 0.002 |
| 8317 | 0.001 |
| 8318 | 0.005 |
| 8319 | 0.005 |
| 8320 | 0.001 |
| 8321 | 0.003 |
| 8322 | 0.003 |
| 8323 | 0.008 |
| 8324 | 0.006 |
| 8325 | 0.003 |
| 8326 | 0.005 |
| 8327 | 0.003 |
| 8328 | 0.004 |
| 8329 | 0.002 |
| 8330 | 0.003 |
| 8331 | 0.005 |
| 8332 | 0.003 |
| 8333 | 0.004 |
| 8334 | 0.003 |
| 8335 | 0.003 |
| 8336 | 0.005 |
| 8337 | 0.003 |
| 8338 | 0.002 |
| 8339 | 0.003 |
| 8340 | 0.001 |
| 8341 | 0.003 |
| 8342 | 0.005 |
| 8343 | 0.003 |
| 8344 | 0.004 |
| 8345 | 0.002 |
| 8346 | 0.006 |
| 8347 | 0.005 |
| 8348 | 0.003 |
| 8349 | 0.002 |
| 8350 | 0.003 |
| 8351 | 0.004 |
| 8352 | 0.006 |
| 8353 | 0.004 |
| 8354 | 0.004 |
| 8355 | 0.004 |
| 8356 | 0.001 |
| 8357 | 0.002 |
| 8358 | 0.004 |
| 8359 | 0.003 |
| 8360 | 0.003 |
| 8361 | 0.001 |
| 8362 | 0.002 |
| 8363 | 0.005 |
| 8364 | 0.005 |
| 8365 | 0.003 |
| 8366 | 0.004 |
| 8367 | 0.002 |
| 8368 | 0.004 |
| 8369 | 0.004 |
| 8370 | 0.003 |
| 8371 | 0.002 |
| 8372 | 0 |
| 8373 | 0.001 |
| 8374 | 0.002 |
| 8375 | 0.002 |
| 8376 | 0.006 |
| 8377 | 0.002 |
| 8378 | 0.004 |
| 8379 | 0.008 |
| 8380 | 0.004 |
| 8381 | 0.004 |
| 8382 | 0.002 |
| 8383 | 0.003 |
| 8384 | 0.003 |
| 8385 | 0.003 |
| 8386 | 0.008 |
| 8387 | 0.004 |
| 8388 | 0.003 |
| 8389 | 0.006 |
| 8390 | 0.005 |
| 8391 | 0.01 |
| 8392 | 0.004 |
| 8393 | 0.001 |
| 8394 | 0.003 |
| 8395 | 0.004 |
| 8396 | 0.002 |
| 8397 | 0.003 |
| 8398 | 0.004 |
| 8399 | 0.01 |
| 8400 | 0.005 |
| 8401 | 0.003 |
| 8402 | 0.004 |
| 8403 | 0.003 |
| 8404 | 0.003 |
| 8405 | 0.004 |
| 8406 | 0.006 |
| 8407 | 0.007 |
| 8408 | 0.002 |
| 8409 | 0.001 |
| 8410 | 0.004 |
| 8411 | 0.003 |
| 8412 | 0.007 |
| 8413 | 0.011 |
| 8414 | 0.01 |
| 8415 | 0.008 |
| 8416 | 0.002 |
| 8417 | 0.006 |
| 8418 | 0.007 |
| 8419 | 0.003 |
| 8420 | 0.004 |
| 8421 | 0.004 |
| 8422 | 0.003 |
| 8423 | 0.003 |
| 8424 | 0.004 |
| 8425 | 0 |
| 8426 | 0.002 |
| 8427 | 0.006 |
| 8428 | 0.002 |
| 8429 | 0.002 |
| 8430 | 0.005 |
| 8431 | 0.002 |
| 8432 | 0.007 |
| 8433 | 0.004 |
| 8434 | 0.002 |
| 8435 | 0.002 |
| 8436 | 0.002 |
| 8437 | 0.002 |
| 8438 | 0.001 |
| 8439 | 0.009 |
| 8440 | 0.005 |
| 8441 | 0.004 |
| 8442 | 0.007 |
| 8443 | 0.002 |
| 8444 | 0.003 |
| 8445 | 0.008 |
| 8446 | 0.002 |
| 8447 | 0.003 |
| 8448 | 0.006 |
| 8449 | 0.003 |
| 8450 | 0.004 |
| 8451 | 0.005 |
| 8452 | 0.005 |
| 8453 | 0.001 |
| 8454 | 0.004 |
| 8455 | 0.004 |
| 8456 | 0.005 |
| 8457 | 0.003 |
| 8458 | 0.01 |
| 8459 | 0.003 |
| 8460 | 0.001 |
| 8461 | 0.005 |
| 8462 | 0.005 |
| 8463 | 0.003 |
| 8464 | 0.004 |
| 8465 | 0.006 |
| 8466 | 0.008 |
| 8467 | 0.007 |
| 8468 | 0.004 |
| 8469 | 0.004 |
| 8470 | 0.004 |
| 8471 | 0.005 |
| 8472 | 0.001 |
| 8473 | 0.002 |
| 8474 | 0.004 |
| 8475 | 0.002 |
| 8476 | 0.006 |
| 8477 | 0.004 |
| 8478 | 0.004 |
| 8479 | 0.006 |
| 8480 | 0.002 |
| 8481 | 0.002 |
| 8482 | 0.01 |
| 8483 | 0.012 |
| 8484 | 0.003 |
| 8485 | 0.006 |
| 8486 | 0.006 |
| 8487 | 0.006 |
| 8488 | 0.005 |
| 8489 | 0.006 |
| 8490 | 0.001 |
| 8491 | 0.003 |
| 8492 | 0.004 |
| 8493 | 0.004 |
| 8494 | 0.006 |
| 8495 | 0.005 |
| 8496 | 0.001 |
| 8497 | 0.004 |
| 8498 | 0.007 |
| 8499 | 0.006 |
| 8500 | 0.003 |
| 8501 | 0.004 |
| 8502 | 0.003 |
| 8503 | 0.007 |
| 8504 | 0.011 |
| 8505 | 0.012 |
| 8506 | 0.007 |
| 8507 | 0.009 |
| 8508 | 0.005 |
| 8509 | 0.005 |
| 8510 | 0.003 |
| 8511 | 0.003 |
| 8512 | 0.002 |
| 8513 | 0.001 |
| 8514 | 0.01 |
| 8515 | 0.009 |
| 8516 | 0.005 |
| 8517 | 0.002 |
| 8518 | 0.005 |
| 8519 | 0.006 |
| 8520 | 0.002 |
| 8521 | 0.001 |
| 8522 | 0.003 |
| 8523 | 0.007 |
| 8524 | 0.005 |
| 8525 | 0.002 |
| 8526 | 0.001 |
| 8527 | 0.006 |
| 8528 | 0.008 |
| 8529 | 0.002 |
| 8530 | 0.007 |
| 8531 | 0.003 |
| 8532 | 0.006 |
| 8533 | 0.007 |
| 8534 | 0.003 |
| 8535 | 0.004 |
| 8536 | 0.011 |
| 8537 | 0.003 |
| 8538 | 0.007 |
| 8539 | 0.008 |
| 8540 | 0.006 |
| 8541 | 0.003 |
| 8542 | 0.001 |
| 8543 | 0.003 |
| 8544 | 0.012 |
| 8545 | 0.001 |
| 8546 | 0.002 |
| 8547 | 0.003 |
| 8548 | 0.005 |
| 8549 | 0.007 |
| 8550 | 0.01 |
| 8551 | 0.01 |
| 8552 | 0.003 |
| 8553 | 0.001 |
| 8554 | 0.004 |
| 8555 | 0.006 |
| 8556 | 0.001 |
| 8557 | 0.006 |
| 8558 | 0.004 |
| 8559 | 0.009 |
| 8560 | 0.003 |
| 8561 | 0.002 |
| 8562 | 0.001 |
| 8563 | 0.002 |
| 8564 | 0.004 |
| 8565 | 0.002 |
| 8566 | 0.006 |
| 8567 | 0.005 |
| 8568 | 0.004 |
| 8569 | 0.002 |
| 8570 | 0.004 |
| 8571 | 0.003 |
| 8572 | 0.001 |
| 8573 | 0.004 |
| 8574 | 0.005 |
| 8575 | 0.003 |
| 8576 | 0.003 |
| 8577 | 0.001 |
| 8578 | 0.008 |
| 8579 | 0.005 |
| 8580 | 0.003 |
| 8581 | 0.002 |
| 8582 | 0.007 |
| 8583 | 0.007 |
| 8584 | 0.004 |
| 8585 | 0.004 |
| 8586 | 0.002 |
| 8587 | 0.005 |
| 8588 | 0.002 |
| 8589 | 0.002 |
| 8590 | 0.008 |
| 8591 | 0.005 |
| 8592 | 0.003 |
| 8593 | 0.001 |
| 8594 | 0.006 |
| 8595 | 0.004 |
| 8596 | 0.003 |
| 8597 | 0.001 |
| 8598 | 0.003 |
| 8599 | 0.005 |
| 8600 | 0.003 |
| 8601 | 0.003 |
| 8602 | 0.004 |
| 8603 | 0.005 |
| 8604 | 0.001 |
| 8605 | 0.003 |
| 8606 | 0.004 |
| 8607 | 0.003 |
| 8608 | 0.002 |
| 8609 | 0.002 |
| 8610 | 0.001 |
| 8611 | 0.006 |
| 8612 | 0.001 |
| 8613 | 0.004 |
| 8614 | 0.007 |
| 8615 | 0.005 |
| 8616 | 0.002 |
| 8617 | 0.002 |
| 8618 | 0.004 |
| 8619 | 0.004 |
| 8620 | 0.001 |
| 8621 | 0.001 |
| 8622 | 0.001 |
| 8623 | 0.006 |
| 8624 | 0.002 |
| 8625 | 0.002 |
| 8626 | 0.002 |
| 8627 | 0.004 |
| 8628 | 0.002 |
| 8629 | 0.001 |
| 8630 | 0.002 |
| 8631 | 0.005 |
| 8632 | 0.002 |
| 8633 | 0.002 |
| 8634 | 0.007 |
| 8635 | 0.005 |
| 8636 | 0.002 |
| 8637 | 0.006 |
| 8638 | 0.003 |
| 8639 | 0.004 |
| 8640 | 0.005 |
| 8641 | 0.001 |
| 8642 | 0.001 |
| 8643 | 0.004 |
| 8644 | 0.01 |
| 8645 | 0.002 |
| 8646 | 0.003 |
| 8647 | 0.007 |
| 8648 | 0.006 |
| 8649 | 0.008 |
| 8650 | 0.002 |
| 8651 | 0.004 |
| 8652 | 0.005 |
| 8653 | 0.003 |
| 8654 | 0.001 |
| 8655 | 0.001 |
| 8656 | 0.004 |
| 8657 | 0.007 |
| 8658 | 0.009 |
| 8659 | 0.005 |
| 8660 | 0.002 |
| 8661 | 0.005 |
| 8662 | 0.004 |
| 8663 | 0.003 |
| 8664 | 0.003 |
| 8665 | 0.005 |
| 8666 | 0.005 |
| 8667 | 0.005 |
| 8668 | 0.003 |
| 8669 | 0.003 |
| 8670 | 0.005 |
| 8671 | 0.005 |
| 8672 | 0.001 |
| 8673 | 0.003 |
| 8674 | 0.002 |
| 8675 | 0.002 |
| 8676 | 0.002 |
| 8677 | 0.001 |
| 8678 | 0.001 |
| 8679 | 0.005 |
| 8680 | 0.004 |
| 8681 | 0.002 |
| 8682 | 0.004 |
| 8683 | 0.007 |
| 8684 | 0.004 |
| 8685 | 0.005 |
| 8686 | 0.004 |
| 8687 | 0.002 |
| 8688 | 0.003 |
| 8689 | 0.006 |
| 8690 | 0.001 |
| 8691 | 0.002 |
| 8692 | 0.007 |
| 8693 | 0.004 |
| 8694 | 0.004 |
| 8695 | 0.005 |
| 8696 | 0.002 |
| 8697 | 0.002 |
| 8698 | 0.003 |
| 8699 | 0.003 |
| 8700 | 0.003 |
| 8701 | 0.005 |
| 8702 | 0.008 |
| 8703 | 0.005 |
| 8704 | 0.003 |
| 8705 | 0.002 |
| 8706 | 0.007 |
| 8707 | 0.002 |
| 8708 | 0.006 |
| 8709 | 0.004 |
| 8710 | 0.004 |
| 8711 | 0.006 |
| 8712 | 0.003 |
| 8713 | 0.003 |
| 8714 | 0.005 |
| 8715 | 0.003 |
| 8716 | 0.002 |
| 8717 | 0.002 |
| 8718 | 0.003 |
| 8719 | 0.002 |
| 8720 | 0.004 |
| 8721 | 0.005 |
| 8722 | 0.007 |
| 8723 | 0.003 |
| 8724 | 0.009 |
| 8725 | 0.003 |
| 8726 | 0.007 |
| 8727 | 0.001 |
| 8728 | 0.005 |
| 8729 | 0.001 |
| 8730 | 0.004 |
| 8731 | 0.004 |
| 8732 | 0.008 |
| 8733 | 0.001 |
| 8734 | 0.002 |
| 8735 | 0.004 |
| 8736 | 0.003 |
| 8737 | 0.001 |
| 8738 | 0.004 |
| 8739 | 0.006 |
| 8740 | 0.006 |
| 8741 | 0.002 |
| 8742 | 0.009 |
| 8743 | 0.003 |
| 8744 | 0.002 |
| 8745 | 0.002 |
| 8746 | 0.003 |
| 8747 | 0.002 |
| 8748 | 0.003 |
| 8749 | 0.003 |
| 8750 | 0.005 |
| 8751 | 0.005 |
| 8752 | 0.001 |
| 8753 | 0.005 |
| 8754 | 0.002 |
| 8755 | 0.002 |
| 8756 | 0.005 |
| 8757 | 0.004 |
| 8758 | 0.002 |
| 8759 | 0.004 |
| 8760 | 0.001 |
| 8761 | 0.002 |
| 8762 | 0.003 |
| 8763 | 0.002 |
| 8764 | 0.005 |
| 8765 | 0.005 |
| 8766 | 0.003 |
| 8767 | 0.003 |
| 8768 | 0.002 |
| 8769 | 0.002 |
| 8770 | 0.008 |
| 8771 | 0.002 |
| 8772 | 0.004 |
| 8773 | 0.008 |
| 8774 | 0.008 |
| 8775 | 0.009 |
| 8776 | 0.01 |
| 8777 | 0.008 |
| 8778 | 0.004 |
| 8779 | 0.006 |
| 8780 | 0.008 |
| 8781 | 0.003 |
| 8782 | 0.003 |
| 8783 | 0.008 |
| 8784 | 0.006 |
| 8785 | 0.006 |
| 8786 | 0.007 |
| 8787 | 0.003 |
| 8788 | 0.002 |
| 8789 | 0.01 |
| 8790 | 0.007 |
| 8791 | 0.004 |
| 8792 | 0.01 |
| 8793 | 0.006 |
| 8794 | 0.004 |
| 8795 | 0.004 |
| 8796 | 0.001 |
| 8797 | 0.01 |
| 8798 | 0.007 |
| 8799 | 0.004 |
| 8800 | 0.004 |
| 8801 | 0.002 |
| 8802 | 0.002 |
| 8803 | 0.002 |
| 8804 | 0.003 |
| 8805 | 0.006 |
| 8806 | 0.003 |
| 8807 | 0.003 |
| 8808 | 0.004 |
| 8809 | 0.008 |
| 8810 | 0.002 |
| 8811 | 0.002 |
| 8812 | 0.005 |
| 8813 | 0.005 |
| 8814 | 0.004 |
| 8815 | 0.003 |
| 8816 | 0.003 |
| 8817 | 0.004 |
| 8818 | 0.003 |
| 8819 | 0.003 |
| 8820 | 0.005 |
| 8821 | 0.003 |
| 8822 | 0.004 |
| 8823 | 0.009 |
| 8824 | 0.003 |
| 8825 | 0.003 |
| 8826 | 0.007 |
| 8827 | 0.003 |
| 8828 | 0.005 |
| 8829 | 0.003 |
| 8830 | 0.004 |
| 8831 | 0.005 |
| 8832 | 0.002 |
| 8833 | 0.004 |
| 8834 | 0.002 |
| 8835 | 0.003 |
| 8836 | 0.001 |
| 8837 | 0.003 |
| 8838 | 0.004 |
| 8839 | 0.003 |
| 8840 | 0.003 |
| 8841 | 0.003 |
| 8842 | 0.009 |
| 8843 | 0.002 |
| 8844 | 0.001 |
| 8845 | 0.002 |
| 8846 | 0.006 |
| 8847 | 0.005 |
| 8848 | 0.001 |
| 8849 | 0.003 |
| 8850 | 0.005 |
| 8851 | 0.003 |
| 8852 | 0.001 |
| 8853 | 0.002 |
| 8854 | 0.001 |
| 8855 | 0.006 |
| 8856 | 0.004 |
| 8857 | 0.002 |
| 8858 | 0.004 |
| 8859 | 0.005 |
| 8860 | 0.005 |
| 8861 | 0.008 |
| 8862 | 0.002 |
| 8863 | 0.004 |
| 8864 | 0.003 |
| 8865 | 0.003 |
| 8866 | 0.006 |
| 8867 | 0.004 |
| 8868 | 0.002 |
| 8869 | 0.002 |
| 8870 | 0.005 |
| 8871 | 0.004 |
| 8872 | 0.003 |
| 8873 | 0.005 |
| 8874 | 0.011 |
| 8875 | 0.007 |
| 8876 | 0.004 |
| 8877 | 0.005 |
| 8878 | 0.006 |
| 8879 | 0.005 |
| 8880 | 0.005 |
| 8881 | 0.002 |
| 8882 | 0.003 |
| 8883 | 0.004 |
| 8884 | 0.004 |
| 8885 | 0.003 |
| 8886 | 0.005 |
| 8887 | 0.007 |
| 8888 | 0.004 |
| 8889 | 0.003 |
| 8890 | 0.006 |
| 8891 | 0.003 |
| 8892 | 0.002 |
| 8893 | 0.004 |
| 8894 | 0.006 |
| 8895 | 0.006 |
| 8896 | 0.003 |
| 8897 | 0.002 |
| 8898 | 0.002 |
| 8899 | 0.008 |
| 8900 | 0.004 |
| 8901 | 0.003 |
| 8902 | 0.002 |
| 8903 | 0.007 |
| 8904 | 0.002 |
| 8905 | 0.006 |
| 8906 | 0.006 |
| 8907 | 0.002 |
| 8908 | 0.001 |
| 8909 | 0.003 |
| 8910 | 0.006 |
| 8911 | 0.001 |
| 8912 | 0.001 |
| 8913 | 0.003 |
| 8914 | 0.001 |
| 8915 | 0.002 |
| 8916 | 0.003 |
| 8917 | 0.002 |
| 8918 | 0.004 |
| 8919 | 0.005 |
| 8920 | 0.002 |
| 8921 | 0.003 |
| 8922 | 0.005 |
| 8923 | 0.005 |
| 8924 | 0.004 |
| 8925 | 0.003 |
| 8926 | 0.005 |
| 8927 | 0.008 |
| 8928 | 0.004 |
| 8929 | 0.003 |
| 8930 | 0.004 |
| 8931 | 0.006 |
| 8932 | 0.001 |
| 8933 | 0.006 |
| 8934 | 0.006 |
| 8935 | 0.006 |
| 8936 | 0.004 |
| 8937 | 0.005 |
| 8938 | 0.003 |
| 8939 | 0.002 |
| 8940 | 0.005 |
| 8941 | 0.003 |
| 8942 | 0.009 |
| 8943 | 0.009 |
| 8944 | 0.002 |
| 8945 | 0.002 |
| 8946 | 0.005 |
| 8947 | 0.005 |
| 8948 | 0.01 |
| 8949 | 0.005 |
| 8950 | 0.003 |
| 8951 | 0.005 |
| 8952 | 0.001 |
| 8953 | 0.004 |
| 8954 | 0.004 |
| 8955 | 0.003 |
| 8956 | 0.001 |
| 8957 | 0.005 |
| 8958 | 0.003 |
| 8959 | 0.002 |
| 8960 | 0.001 |
| 8961 | 0.003 |
| 8962 | 0.002 |
| 8963 | 0.006 |
| 8964 | 0.004 |
| 8965 | 0.002 |
| 8966 | 0.004 |
| 8967 | 0.005 |
| 8968 | 0.002 |
| 8969 | 0.004 |
| 8970 | 0.004 |
| 8971 | 0.003 |
| 8972 | 0.001 |
| 8973 | 0.002 |
| 8974 | 0.002 |
| 8975 | 0.002 |
| 8976 | 0.003 |
| 8977 | 0.006 |
| 8978 | 0.009 |
| 8979 | 0.007 |
| 8980 | 0.004 |
| 8981 | 0.005 |
| 8982 | 0.004 |
| 8983 | 0.004 |
| 8984 | 0.001 |
| 8985 | 0.002 |
| 8986 | 0.006 |
| 8987 | 0.009 |
| 8988 | 0.005 |
| 8989 | 0.003 |
| 8990 | 0.006 |
| 8991 | 0.002 |
| 8992 | 0.002 |
| 8993 | 0.001 |
| 8994 | 0.009 |
| 8995 | 0.003 |
| 8996 | 0.004 |
| 8997 | 0.001 |
| 8998 | 0.003 |
| 8999 | 0.001 |
| 9000 | 0.004 |
| 9001 | 0.004 |
| 9002 | 0.003 |
| 9003 | 0.003 |
| 9004 | 0.008 |
| 9005 | 0.004 |
| 9006 | 0.01 |
| 9007 | 0.007 |
| 9008 | 0.003 |
| 9009 | 0.005 |
| 9010 | 0.004 |
| 9011 | 0.005 |
| 9012 | 0.004 |
| 9013 | 0.003 |
| 9014 | 0.003 |
| 9015 | 0.002 |
| 9016 | 0.011 |
| 9017 | 0.004 |
| 9018 | 0.005 |
| 9019 | 0.004 |
| 9020 | 0.004 |
| 9021 | 0.004 |
| 9022 | 0.005 |
| 9023 | 0.003 |
| 9024 | 0.006 |
| 9025 | 0.002 |
| 9026 | 0.002 |
| 9027 | 0.006 |
| 9028 | 0.004 |
| 9029 | 0.002 |
| 9030 | 0.003 |
| 9031 | 0.001 |
| 9032 | 0.003 |
| 9033 | 0.006 |
| 9034 | 0.004 |
| 9035 | 0.005 |
| 9036 | 0.003 |
| 9037 | 0.006 |
| 9038 | 0.004 |
| 9039 | 0.006 |
| 9040 | 0.008 |
| 9041 | 0.008 |
| 9042 | 0.006 |
| 9043 | 0.006 |
| 9044 | 0.007 |
| 9045 | 0.002 |
| 9046 | 0.002 |
| 9047 | 0.007 |
| 9048 | 0.005 |
| 9049 | 0.003 |
| 9050 | 0.006 |
| 9051 | 0.01 |
| 9052 | 0.013 |
| 9053 | 0.006 |
| 9054 | 0.004 |
| 9055 | 0.008 |
| 9056 | 0.01 |
| 9057 | 0.003 |
| 9058 | 0.005 |
| 9059 | 0.005 |
| 9060 | 0.001 |
| 9061 | 0.001 |
| 9062 | 0.002 |
| 9063 | 0.008 |
| 9064 | 0.001 |
| 9065 | 0.007 |
| 9066 | 0.008 |
| 9067 | 0.004 |
| 9068 | 0.005 |
| 9069 | 0.003 |
| 9070 | 0.005 |
| 9071 | 0.004 |
| 9072 | 0.003 |
| 9073 | 0.001 |
| 9074 | 0.005 |
| 9075 | 0.003 |
| 9076 | 0.007 |
| 9077 | 0.005 |
| 9078 | 0.005 |
| 9079 | 0.003 |
| 9080 | 0.006 |
| 9081 | 0.009 |
| 9082 | 0.004 |
| 9083 | 0.007 |
| 9084 | 0.005 |
| 9085 | 0.003 |
| 9086 | 0.003 |
| 9087 | 0.001 |
| 9088 | 0.001 |
| 9089 | 0.006 |
| 9090 | 0.003 |
| 9091 | 0.002 |
| 9092 | 0.002 |
| 9093 | 0.005 |
| 9094 | 0.006 |
| 9095 | 0.006 |
| 9096 | 0.006 |
| 9097 | 0.003 |
| 9098 | 0.003 |
| 9099 | 0.003 |
| 9100 | 0.005 |
| 9101 | 0.004 |
| 9102 | 0.003 |
| 9103 | 0.001 |
| 9104 | 0.003 |
| 9105 | 0.004 |
| 9106 | 0.006 |
| 9107 | 0.006 |
| 9108 | 0.008 |
| 9109 | 0.006 |
| 9110 | 0.011 |
| 9111 | 0.008 |
| 9112 | 0.005 |
| 9113 | 0.003 |
| 9114 | 0.011 |
| 9115 | 0.003 |
| 9116 | 0.004 |
| 9117 | 0.002 |
| 9118 | 0.003 |
| 9119 | 0.003 |
| 9120 | 0.004 |
| 9121 | 0.005 |
| 9122 | 0.004 |
| 9123 | 0.005 |
| 9124 | 0.005 |
| 9125 | 0.005 |
| 9126 | 0.005 |
| 9127 | 0.009 |
| 9128 | 0.004 |
| 9129 | 0.007 |
| 9130 | 0.006 |
| 9131 | 0.003 |
| 9132 | 0.003 |
| 9133 | 0.004 |
| 9134 | 0.003 |
| 9135 | 0.003 |
| 9136 | 0.004 |
| 9137 | 0.004 |
| 9138 | 0.008 |
| 9139 | 0.009 |
| 9140 | 0.002 |
| 9141 | 0.002 |
| 9142 | 0.003 |
| 9143 | 0.003 |
| 9144 | 0.001 |
| 9145 | 0.002 |
| 9146 | 0.004 |
| 9147 | 0.004 |
| 9148 | 0.01 |
| 9149 | 0.007 |
| 9150 | 0.006 |
| 9151 | 0.002 |
| 9152 | 0.002 |
| 9153 | 0.009 |
| 9154 | 0.003 |
| 9155 | 0.005 |
| 9156 | 0.005 |
| 9157 | 0.003 |
| 9158 | 0.002 |
| 9159 | 0.003 |
| 9160 | 0.008 |
| 9161 | 0.002 |
| 9162 | 0.004 |
| 9163 | 0.006 |
| 9164 | 0.004 |
| 9165 | 0.005 |
| 9166 | 0.008 |
| 9167 | 0.003 |
| 9168 | 0.004 |
| 9169 | 0.003 |
| 9170 | 0.006 |
| 9171 | 0.004 |
| 9172 | 0.003 |
| 9173 | 0.003 |
| 9174 | 0.007 |
| 9175 | 0.005 |
| 9176 | 0.003 |
| 9177 | 0.002 |
| 9178 | 0.005 |
| 9179 | 0.007 |
| 9180 | 0.003 |
| 9181 | 0.004 |
| 9182 | 0.005 |
| 9183 | 0.007 |
| 9184 | 0.002 |
| 9185 | 0.001 |
| 9186 | 0.011 |
| 9187 | 0.007 |
| 9188 | 0.001 |
| 9189 | 0.005 |
| 9190 | 0.003 |
| 9191 | 0.004 |
| 9192 | 0.001 |
| 9193 | 0.002 |
| 9194 | 0.004 |
| 9195 | 0.006 |
| 9196 | 0.001 |
| 9197 | 0.004 |
| 9198 | 0.003 |
| 9199 | 0.008 |
| 9200 | 0.002 |
| 9201 | 0.003 |
| 9202 | 0.004 |
| 9203 | 0.007 |
| 9204 | 0.003 |
| 9205 | 0.002 |
| 9206 | 0.001 |
| 9207 | 0.006 |
| 9208 | 0.005 |
| 9209 | 0.001 |
| 9210 | 0.003 |
| 9211 | 0.005 |
| 9212 | 0.007 |
| 9213 | 0.001 |
| 9214 | 0.004 |
| 9215 | 0.005 |
| 9216 | 0.006 |
| 9217 | 0.009 |
| 9218 | 0.006 |
| 9219 | 0.004 |
| 9220 | 0.005 |
| 9221 | 0.002 |
| 9222 | 0.002 |
| 9223 | 0.005 |
| 9224 | 0.006 |
| 9225 | 0.003 |
| 9226 | 0.002 |
| 9227 | 0.001 |
| 9228 | 0.003 |
| 9229 | 0.003 |
| 9230 | 0.003 |
| 9231 | 0.008 |
| 9232 | 0.008 |
| 9233 | 0.004 |
| 9234 | 0.002 |
| 9235 | 0.005 |
| 9236 | 0.006 |
| 9237 | 0.001 |
| 9238 | 0.004 |
| 9239 | 0.003 |
| 9240 | 0.005 |
| 9241 | 0.002 |
| 9242 | 0.002 |
| 9243 | 0.003 |
| 9244 | 0.004 |
| 9245 | 0.002 |
| 9246 | 0.002 |
| 9247 | 0.004 |
| 9248 | 0.003 |
| 9249 | 0.001 |
| 9250 | 0.003 |
| 9251 | 0.01 |
| 9252 | 0.006 |
| 9253 | 0.003 |
| 9254 | 0.001 |
| 9255 | 0.003 |
| 9256 | 0.006 |
| 9257 | 0.005 |
| 9258 | 0.009 |
| 9259 | 0.007 |
| 9260 | 0.004 |
| 9261 | 0.003 |
| 9262 | 0.002 |
| 9263 | 0.003 |
| 9264 | 0.004 |
| 9265 | 0.007 |
| 9266 | 0.005 |
| 9267 | 0.006 |
| 9268 | 0.001 |
| 9269 | 0.001 |
| 9270 | 0.003 |
| 9271 | 0.007 |
| 9272 | 0.002 |
| 9273 | 0.005 |
| 9274 | 0.007 |
| 9275 | 0.004 |
| 9276 | 0.003 |
| 9277 | 0.003 |
| 9278 | 0.006 |
| 9279 | 0.012 |
| 9280 | 0.003 |
| 9281 | 0.003 |
| 9282 | 0.004 |
| 9283 | 0.002 |
| 9284 | 0.002 |
| 9285 | 0.001 |
| 9286 | 0.003 |
| 9287 | 0.002 |
| 9288 | 0.002 |
| 9289 | 0.003 |
| 9290 | 0.003 |
| 9291 | 0.003 |
| 9292 | 0.003 |
| 9293 | 0.009 |
| 9294 | 0.006 |
| 9295 | 0.006 |
| 9296 | 0.003 |
| 9297 | 0.006 |
| 9298 | 0.006 |
| 9299 | 0.003 |
| 9300 | 0.006 |
| 9301 | 0.005 |
| 9302 | 0.003 |
| 9303 | 0.004 |
| 9304 | 0.005 |
| 9305 | 0.002 |
| 9306 | 0.006 |
| 9307 | 0.004 |
| 9308 | 0.002 |
| 9309 | 0.001 |
| 9310 | 0.003 |
| 9311 | 0.005 |
| 9312 | 0.004 |
| 9313 | 0.002 |
| 9314 | 0.005 |
| 9315 | 0.004 |
| 9316 | 0.008 |
| 9317 | 0.003 |
| 9318 | 0.003 |
| 9319 | 0.002 |
| 9320 | 0.002 |
| 9321 | 0.004 |
| 9322 | 0.002 |
| 9323 | 0.002 |
| 9324 | 0.002 |
| 9325 | 0.003 |
| 9326 | 0.007 |
| 9327 | 0.003 |
| 9328 | 0.007 |
| 9329 | 0.006 |
| 9330 | 0.002 |
| 9331 | 0.001 |
| 9332 | 0.002 |
| 9333 | 0.006 |
| 9334 | 0.003 |
| 9335 | 0.003 |
| 9336 | 0.006 |
| 9337 | 0.01 |
| 9338 | 0.001 |
| 9339 | 0.011 |
| 9340 | 0.002 |
| 9341 | 0.007 |
| 9342 | 0.002 |
| 9343 | 0.006 |
| 9344 | 0.002 |
| 9345 | 0.002 |
| 9346 | 0.005 |
| 9347 | 0.006 |
| 9348 | 0.006 |
| 9349 | 0.005 |
| 9350 | 0.006 |
| 9351 | 0.005 |
| 9352 | 0.001 |
| 9353 | 0.003 |
| 9354 | 0.003 |
| 9355 | 0.003 |
| 9356 | 0.005 |
| 9357 | 0.005 |
| 9358 | 0.006 |
| 9359 | 0.008 |
| 9360 | 0.009 |
| 9361 | 0.002 |
| 9362 | 0 |
| 9363 | 0.005 |
| 9364 | 0.005 |
| 9365 | 0.003 |
| 9366 | 0.004 |
| 9367 | 0.002 |
| 9368 | 0.007 |
| 9369 | 0.005 |
| 9370 | 0.004 |
| 9371 | 0.004 |
| 9372 | 0.003 |
| 9373 | 0.008 |
| 9374 | 0.003 |
| 9375 | 0.005 |
| 9376 | 0.006 |
| 9377 | 0.006 |
| 9378 | 0.006 |
| 9379 | 0.004 |
| 9380 | 0.004 |
| 9381 | 0.005 |
| 9382 | 0.006 |
| 9383 | 0.004 |
| 9384 | 0.003 |
| 9385 | 0.004 |
| 9386 | 0.006 |
| 9387 | 0.008 |
| 9388 | 0.002 |
| 9389 | 0.002 |
| 9390 | 0.005 |
| 9391 | 0.006 |
| 9392 | 0.001 |
| 9393 | 0.009 |
| 9394 | 0.007 |
| 9395 | 0.002 |
| 9396 | 0.002 |
| 9397 | 0.007 |
| 9398 | 0.003 |
| 9399 | 0.002 |
| 9400 | 0.002 |
| 9401 | 0.003 |
| 9402 | 0.004 |
| 9403 | 0.004 |
| 9404 | 0.005 |
| 9405 | 0.005 |
| 9406 | 0.005 |
| 9407 | 0.004 |
| 9408 | 0.007 |
| 9409 | 0.003 |
| 9410 | 0.006 |
| 9411 | 0.006 |
| 9412 | 0.004 |
| 9413 | 0.004 |
| 9414 | 0.011 |
| 9415 | 0.01 |
| 9416 | 0.002 |
| 9417 | 0.001 |
| 9418 | 0.006 |
| 9419 | 0.005 |
| 9420 | 0.003 |
| 9421 | 0.002 |
| 9422 | 0.004 |
| 9423 | 0.006 |
| 9424 | 0.004 |
| 9425 | 0.003 |
| 9426 | 0.005 |
| 9427 | 0.009 |
| 9428 | 0.002 |
| 9429 | 0.004 |
| 9430 | 0.005 |
| 9431 | 0.003 |
| 9432 | 0.006 |
| 9433 | 0.005 |
| 9434 | 0.007 |
| 9435 | 0.005 |
| 9436 | 0.001 |
| 9437 | 0.002 |
| 9438 | 0.003 |
| 9439 | 0.006 |
| 9440 | 0.002 |
| 9441 | 0.003 |
| 9442 | 0.009 |
| 9443 | 0.007 |
| 9444 | 0.005 |
| 9445 | 0.004 |
| 9446 | 0.009 |
| 9447 | 0.006 |
| 9448 | 0.002 |
| 9449 | 0.004 |
| 9450 | 0.007 |
| 9451 | 0.006 |
| 9452 | 0.003 |
| 9453 | 0.004 |
| 9454 | 0.009 |
| 9455 | 0.01 |
| 9456 | 0.003 |
| 9457 | 0.004 |
| 9458 | 0.005 |
| 9459 | 0.01 |
| 9460 | 0.002 |
| 9461 | 0.002 |
| 9462 | 0.007 |
| 9463 | 0.009 |
| 9464 | 0.002 |
| 9465 | 0.004 |
| 9466 | 0.006 |
| 9467 | 0.006 |
| 9468 | 0.002 |
| 9469 | 0.002 |
| 9470 | 0.003 |
| 9471 | 0.007 |
| 9472 | 0.003 |
| 9473 | 0.003 |
| 9474 | 0.006 |
| 9475 | 0.003 |
| 9476 | 0.001 |
| 9477 | 0.004 |
| 9478 | 0.002 |
| 9479 | 0.005 |
| 9480 | 0.004 |
| 9481 | 0.004 |
| 9482 | 0.002 |
| 9483 | 0.005 |
| 9484 | 0.002 |
| 9485 | 0.003 |
| 9486 | 0.009 |
| 9487 | 0.004 |
| 9488 | 0.004 |
| 9489 | 0.004 |
| 9490 | 0.011 |
| 9491 | 0.002 |
| 9492 | 0.004 |
| 9493 | 0.002 |
| 9494 | 0.006 |
| 9495 | 0.004 |
| 9496 | 0.002 |
| 9497 | 0.002 |
| 9498 | 0.008 |
| 9499 | 0.006 |
| 9500 | 0.004 |
| 9501 | 0.003 |
| 9502 | 0.004 |
| 9503 | 0.003 |
| 9504 | 0.006 |
| 9505 | 0.003 |
| 9506 | 0.005 |
| 9507 | 0.007 |
| 9508 | 0.002 |
| 9509 | 0.002 |
| 9510 | 0.003 |
| 9511 | 0.006 |
| 9512 | 0.003 |
| 9513 | 0.002 |
| 9514 | 0.004 |
| 9515 | 0.01 |
| 9516 | 0.004 |
| 9517 | 0.004 |
| 9518 | 0.005 |
| 9519 | 0.007 |
| 9520 | 0.004 |
| 9521 | 0.003 |
| 9522 | 0.007 |
| 9523 | 0.005 |
| 9524 | 0.002 |
| 9525 | 0.003 |
| 9526 | 0.006 |
| 9527 | 0.006 |
| 9528 | 0.002 |
| 9529 | 0.003 |
| 9530 | 0.004 |
| 9531 | 0.005 |
| 9532 | 0.004 |
| 9533 | 0.003 |
| 9534 | 0.006 |
| 9535 | 0.008 |
| 9536 | 0.005 |
| 9537 | 0.003 |
| 9538 | 0.004 |
| 9539 | 0.006 |
| 9540 | 0.002 |
| 9541 | 0.002 |
| 9542 | 0.004 |
| 9543 | 0.005 |
| 9544 | 0.003 |
| 9545 | 0.002 |
| 9546 | 0.001 |
| 9547 | 0.006 |
| 9548 | 0.004 |
| 9549 | 0.004 |
| 9550 | 0.002 |
| 9551 | 0.003 |
| 9552 | 0.001 |
| 9553 | 0.008 |
| 9554 | 0.005 |
| 9555 | 0.002 |
| 9556 | 0.004 |
| 9557 | 0.002 |
| 9558 | 0.006 |
| 9559 | 0.005 |
| 9560 | 0.002 |
| 9561 | 0.002 |
| 9562 | 0.007 |
| 9563 | 0.006 |
| 9564 | 0.003 |
| 9565 | 0.002 |
| 9566 | 0.006 |
| 9567 | 0.006 |
| 9568 | 0.002 |
| 9569 | 0.003 |
| 9570 | 0.002 |
| 9571 | 0.002 |
| 9572 | 0.003 |
| 9573 | 0.001 |
| 9574 | 0.005 |
| 9575 | 0.001 |
| 9576 | 0.003 |
| 9577 | 0.006 |
| 9578 | 0.003 |
| 9579 | 0.003 |
| 9580 | 0.005 |
| 9581 | 0.001 |
| 9582 | 0.002 |
| 9583 | 0.002 |
| 9584 | 0.003 |
| 9585 | 0.003 |
| 9586 | 0.005 |
| 9587 | 0.006 |
| 9588 | 0.002 |
| 9589 | 0.002 |
| 9590 | 0.013 |
| 9591 | 0.012 |
| 9592 | 0.002 |
| 9593 | 0.002 |
| 9594 | 0.002 |
| 9595 | 0.003 |
| 9596 | 0.002 |
| 9597 | 0.004 |
| 9598 | 0.007 |
| 9599 | 0.008 |
| 9600 | 0.004 |
| 9601 | 0.008 |
| 9602 | 0.005 |
| 9603 | 0.005 |
| 9604 | 0.003 |
| 9605 | 0.004 |
| 9606 | 0.002 |
| 9607 | 0.005 |
| 9608 | 0.002 |
| 9609 | 0.002 |
| 9610 | 0.003 |
| 9611 | 0.003 |
| 9612 | 0.006 |
| 9613 | 0.004 |
| 9614 | 0.004 |
| 9615 | 0.007 |
| 9616 | 0.004 |
| 9617 | 0.002 |
| 9618 | 0.007 |
| 9619 | 0.008 |
| 9620 | 0.004 |
| 9621 | 0.002 |
| 9622 | 0.003 |
| 9623 | 0.003 |
| 9624 | 0.003 |
| 9625 | 0.002 |
| 9626 | 0.002 |
| 9627 | 0.002 |
| 9628 | 0.002 |
| 9629 | 0.002 |
| 9630 | 0.005 |
| 9631 | 0.001 |
| 9632 | 0.003 |
| 9633 | 0.005 |
| 9634 | 0.005 |
| 9635 | 0.002 |
| 9636 | 0.004 |
| 9637 | 0.006 |
| 9638 | 0.002 |
| 9639 | 0.005 |
| 9640 | 0.003 |
| 9641 | 0.004 |
| 9642 | 0.002 |
| 9643 | 0.005 |
| 9644 | 0.003 |
| 9645 | 0.007 |
| 9646 | 0.002 |
| 9647 | 0.005 |
| 9648 | 0.002 |
| 9649 | 0.006 |
| 9650 | 0.002 |
| 9651 | 0.002 |
| 9652 | 0.006 |
| 9653 | 0.006 |
| 9654 | 0.001 |
| 9655 | 0.007 |
| 9656 | 0.005 |
| 9657 | 0.004 |
| 9658 | 0.009 |
| 9659 | 0.005 |
| 9660 | 0.009 |
| 9661 | 0.006 |
| 9662 | 0.003 |
| 9663 | 0.006 |
| 9664 | 0.007 |
| 9665 | 0.003 |
| 9666 | 0.007 |
| 9667 | 0.002 |
| 9668 | 0.003 |
| 9669 | 0.005 |
| 9670 | 0.005 |
| 9671 | 0.005 |
| 9672 | 0.002 |
| 9673 | 0.001 |
| 9674 | 0.003 |
| 9675 | 0.006 |
| 9676 | 0.008 |
| 9677 | 0.002 |
| 9678 | 0.002 |
| 9679 | 0.007 |
| 9680 | 0.008 |
| 9681 | 0.003 |
| 9682 | 0.005 |
| 9683 | 0.005 |
| 9684 | 0.003 |
| 9685 | 0.003 |
| 9686 | 0.012 |
| 9687 | 0.008 |
| 9688 | 0.003 |
| 9689 | 0.002 |
| 9690 | 0.003 |
| 9691 | 0.003 |
| 9692 | 0.005 |
| 9693 | 0.003 |
| 9694 | 0.003 |
| 9695 | 0.005 |
| 9696 | 0.006 |
| 9697 | 0.01 |
| 9698 | 0.004 |
| 9699 | 0.006 |
| 9700 | 0.005 |
| 9701 | 0.004 |
| 9702 | 0.003 |
| 9703 | 0.004 |
| 9704 | 0.004 |
| 9705 | 0.009 |
| 9706 | 0.005 |
| 9707 | 0.004 |
| 9708 | 0.004 |
| 9709 | 0.005 |
| 9710 | 0.008 |
| 9711 | 0.015 |
| 9712 | 0.006 |
| 9713 | 0.005 |
| 9714 | 0.001 |
| 9715 | 0.002 |
| 9716 | 0.001 |
| 9717 | 0.002 |
| 9718 | 0.002 |
| 9719 | 0.005 |
| 9720 | 0.007 |
| 9721 | 0.008 |
| 9722 | 0.004 |
| 9723 | 0.006 |
| 9724 | 0.007 |
| 9725 | 0.004 |
| 9726 | 0.004 |
| 9727 | 0.004 |
| 9728 | 0.005 |
| 9729 | 0.002 |
| 9730 | 0.001 |
| 9731 | 0.001 |
| 9732 | 0.004 |
| 9733 | 0.001 |
| 9734 | 0.003 |
| 9735 | 0.005 |
| 9736 | 0.004 |
| 9737 | 0.002 |
| 9738 | 0.002 |
| 9739 | 0.002 |
| 9740 | 0.003 |
| 9741 | 0.002 |
| 9742 | 0.001 |
| 9743 | 0.007 |
| 9744 | 0.006 |
| 9745 | 0.002 |
| 9746 | 0.005 |
| 9747 | 0.003 |
| 9748 | 0.003 |
| 9749 | 0.003 |
| 9750 | 0.002 |
| 9751 | 0.008 |
| 9752 | 0.004 |
| 9753 | 0.003 |
| 9754 | 0.004 |
| 9755 | 0.003 |
| 9756 | 0.005 |
| 9757 | 0.004 |
| 9758 | 0.003 |
| 9759 | 0.008 |
| 9760 | 0.007 |
| 9761 | 0.003 |
| 9762 | 0.005 |
| 9763 | 0.007 |
| 9764 | 0.005 |
| 9765 | 0.002 |
| 9766 | 0.003 |
| 9767 | 0.005 |
| 9768 | 0.007 |
| 9769 | 0.012 |
| 9770 | 0.01 |
| 9771 | 0.005 |
| 9772 | 0.007 |
| 9773 | 0.002 |
| 9774 | 0.002 |
| 9775 | 0.01 |
| 9776 | 0.006 |
| 9777 | 0.002 |
| 9778 | 0.007 |
| 9779 | 0.007 |
| 9780 | 0.005 |
| 9781 | 0.002 |
| 9782 | 0.007 |
| 9783 | 0.007 |
| 9784 | 0.002 |
| 9785 | 0.003 |
| 9786 | 0.004 |
| 9787 | 0.005 |
| 9788 | 0.002 |
| 9789 | 0.003 |
| 9790 | 0.002 |
| 9791 | 0.003 |
| 9792 | 0.002 |
| 9793 | 0.003 |
| 9794 | 0.003 |
| 9795 | 0.005 |
| 9796 | 0.003 |
| 9797 | 0.003 |
| 9798 | 0.004 |
| 9799 | 0.002 |
| 9800 | 0.004 |
| 9801 | 0.002 |
| 9802 | 0.007 |
| 9803 | 0.007 |
| 9804 | 0.002 |
| 9805 | 0.006 |
| 9806 | 0.002 |
| 9807 | 0.002 |
| 9808 | 0.008 |
| 9809 | 0.005 |
| 9810 | 0.006 |
| 9811 | 0.004 |
| 9812 | 0.004 |
| 9813 | 0.011 |
| 9814 | 0.011 |
| 9815 | 0.006 |
| 9816 | 0.002 |
| 9817 | 0.003 |
| 9818 | 0.002 |
| 9819 | 0.001 |
| 9820 | 0.006 |
| 9821 | 0.005 |
| 9822 | 0.004 |
| 9823 | 0.007 |
| 9824 | 0.003 |
| 9825 | 0.002 |
| 9826 | 0.002 |
| 9827 | 0.01 |
| 9828 | 0.011 |
| 9829 | 0.002 |
| 9830 | 0.003 |
| 9831 | 0.003 |
| 9832 | 0.007 |
| 9833 | 0.004 |
| 9834 | 0.005 |
| 9835 | 0.007 |
| 9836 | 0.004 |
| 9837 | 0.005 |
| 9838 | 0.007 |
| 9839 | 0.011 |
| 9840 | 0.001 |
| 9841 | 0.004 |
| 9842 | 0.007 |
| 9843 | 0.002 |
| 9844 | 0.001 |
| 9845 | 0.002 |
| 9846 | 0.002 |
| 9847 | 0.005 |
| 9848 | 0.004 |
| 9849 | 0.003 |
| 9850 | 0.003 |
| 9851 | 0.009 |
| 9852 | 0.003 |
| 9853 | 0.004 |
| 9854 | 0.004 |
| 9855 | 0.006 |
| 9856 | 0.001 |
| 9857 | 0.003 |
| 9858 | 0.008 |
| 9859 | 0.006 |
| 9860 | 0.004 |
| 9861 | 0.003 |
| 9862 | 0.007 |
| 9863 | 0.001 |
| 9864 | 0.002 |
| 9865 | 0.003 |
| 9866 | 0.002 |
| 9867 | 0.005 |
| 9868 | 0.002 |
| 9869 | 0.003 |
| 9870 | 0.002 |
| 9871 | 0.007 |
| 9872 | 0.003 |
| 9873 | 0.005 |
| 9874 | 0.006 |
| 9875 | 0.005 |
| 9876 | 0.003 |
| 9877 | 0.003 |
| 9878 | 0.01 |
| 9879 | 0.004 |
| 9880 | 0.003 |
| 9881 | 0.001 |
| 9882 | 0.003 |
| 9883 | 0.006 |
| 9884 | 0.004 |
| 9885 | 0.005 |
| 9886 | 0.005 |
| 9887 | 0.004 |
| 9888 | 0.005 |
| 9889 | 0.006 |
| 9890 | 0.005 |
| 9891 | 0.004 |
| 9892 | 0.004 |
| 9893 | 0.008 |
| 9894 | 0.006 |
| 9895 | 0.004 |
| 9896 | 0.003 |
| 9897 | 0.003 |
| 9898 | 0.004 |
| 9899 | 0.008 |
| 9900 | 0.006 |
| 9901 | 0.004 |
| 9902 | 0.002 |
| 9903 | 0.005 |
| 9904 | 0.006 |
| 9905 | 0.005 |
| 9906 | 0.003 |
| 9907 | 0.003 |
| 9908 | 0.003 |
| 9909 | 0.003 |
| 9910 | 0.001 |
| 9911 | 0.003 |
| 9912 | 0.005 |
| 9913 | 0.003 |
| 9914 | 0.007 |
| 9915 | 0.004 |
| 9916 | 0.006 |
| 9917 | 0.008 |
| 9918 | 0.002 |
| 9919 | 0.002 |
| 9920 | 0.004 |
| 9921 | 0.003 |
| 9922 | 0.004 |
| 9923 | 0.008 |
| 9924 | 0.003 |
| 9925 | 0.002 |
| 9926 | 0.004 |
| 9927 | 0.008 |
| 9928 | 0.006 |
| 9929 | 0.007 |
| 9930 | 0.013 |
| 9931 | 0.011 |
| 9932 | 0.006 |
| 9933 | 0.003 |
| 9934 | 0.006 |
| 9935 | 0.002 |
| 9936 | 0.004 |
| 9937 | 0.003 |
| 9938 | 0.006 |
| 9939 | 0.004 |
| 9940 | 0.005 |
| 9941 | 0.006 |
| 9942 | 0.007 |
| 9943 | 0.007 |
| 9944 | 0.005 |
| 9945 | 0.002 |
| 9946 | 0.011 |
| 9947 | 0.006 |
| 9948 | 0.002 |
| 9949 | 0.004 |
| 9950 | 0.004 |
| 9951 | 0.001 |
| 9952 | 0.005 |
| 9953 | 0.003 |
| 9954 | 0.001 |
| 9955 | 0.007 |
| 9956 | 0.008 |
| 9957 | 0.005 |
| 9958 | 0.003 |
| 9959 | 0.005 |
| 9960 | 0.002 |
| 9961 | 0.004 |
| 9962 | 0.003 |
| 9963 | 0.001 |
| 9964 | 0.002 |
| 9965 | 0.004 |
| 9966 | 0.003 |
| 9967 | 0.006 |
| 9968 | 0.005 |
| 9969 | 0.01 |
| 9970 | 0.007 |
| 9971 | 0.006 |
| 9972 | 0.002 |
| 9973 | 0.008 |
| 9974 | 0.011 |
| 9975 | 0.009 |
| 9976 | 0.004 |
| 9977 | 0.003 |
| 9978 | 0.001 |
| 9979 | 0.004 |
| 9980 | 0.005 |
| 9981 | 0.009 |
| 9982 | 0.003 |
| 9983 | 0.004 |
| 9984 | 0.004 |
| 9985 | 0.002 |
| 9986 | 0.003 |
| 9987 | 0.003 |
| 9988 | 0.006 |
| 9989 | 0.007 |
| 9990 | 0.005 |
| 9991 | 0.005 |
| 9992 | 0.005 |
| 9993 | 0.008 |
| 9994 | 0.006 |
| 9995 | 0.006 |
| 9996 | 0.005 |
| 9997 | 0.004 |
| 9998 | 0.009 |
| 9999 | 0.006 |
| 10000 | 0.004 |
| 10001 | 0.004 |
| 10002 | 0.004 |
| 10003 | 0.002 |
| 10004 | 0.003 |
| 10005 | 0.003 |
| 10006 | 0.007 |
| 10007 | 0.004 |
| 10008 | 0.008 |
| 10009 | 0.007 |
| 10010 | 0.005 |
| 10011 | 0.003 |
| 10012 | 0.006 |
| 10013 | 0.004 |
| 10014 | 0.002 |
| 10015 | 0.005 |
| 10016 | 0.004 |
| 10017 | 0.004 |
| 10018 | 0.004 |
| 10019 | 0.002 |
| 10020 | 0.009 |
| 10021 | 0.008 |
| 10022 | 0.004 |
| 10023 | 0.002 |
| 10024 | 0.004 |
| 10025 | 0.004 |
| 10026 | 0.004 |
| 10027 | 0.009 |
| 10028 | 0.009 |
| 10029 | 0.007 |
| 10030 | 0.008 |
| 10031 | 0.003 |
| 10032 | 0.004 |
| 10033 | 0.005 |
| 10034 | 0.007 |
| 10035 | 0.008 |
| 10036 | 0.009 |
| 10037 | 0.007 |
| 10038 | 0.002 |
| 10039 | 0.001 |
| 10040 | 0.003 |
| 10041 | 0.005 |
| 10042 | 0.004 |
| 10043 | 0.002 |
| 10044 | 0.008 |
| 10045 | 0.001 |
| 10046 | 0.004 |
| 10047 | 0.002 |
| 10048 | 0.002 |
| 10049 | 0.003 |
| 10050 | 0.001 |
| 10051 | 0.006 |
| 10052 | 0.002 |
| 10053 | 0.002 |
| 10054 | 0.009 |
| 10055 | 0.005 |
| 10056 | 0.002 |
| 10057 | 0.005 |
| 10058 | 0.004 |
| 10059 | 0.004 |
| 10060 | 0.004 |
| 10061 | 0.011 |
| 10062 | 0.013 |
| 10063 | 0.008 |
| 10064 | 0.008 |
| 10065 | 0.006 |
| 10066 | 0.005 |
| 10067 | 0.002 |
| 10068 | 0.004 |
| 10069 | 0.004 |
| 10070 | 0.006 |
| 10071 | 0.007 |
| 10072 | 0.008 |
| 10073 | 0.006 |
| 10074 | 0.007 |
| 10075 | 0.004 |
| 10076 | 0.007 |
| 10077 | 0.005 |
| 10078 | 0.003 |
| 10079 | 0.005 |
| 10080 | 0.005 |
| 10081 | 0.003 |
| 10082 | 0.007 |
| 10083 | 0.001 |
| 10084 | 0.003 |
| 10085 | 0.003 |
| 10086 | 0.001 |
| 10087 | 0.003 |
| 10088 | 0.004 |
| 10089 | 0.012 |
| 10090 | 0.002 |
| 10091 | 0.003 |
| 10092 | 0.003 |
| 10093 | 0.008 |
| 10094 | 0.003 |
| 10095 | 0.005 |
| 10096 | 0.003 |
| 10097 | 0.002 |
| 10098 | 0.002 |
| 10099 | 0.002 |
| 10100 | 0.007 |
| 10101 | 0.003 |
| 10102 | 0.002 |
| 10103 | 0.002 |
| 10104 | 0.006 |
| 10105 | 0.004 |
| 10106 | 0.007 |
| 10107 | 0.005 |
| 10108 | 0.002 |
| 10109 | 0.002 |
| 10110 | 0.005 |
| 10111 | 0.007 |
| 10112 | 0.006 |
| 10113 | 0.006 |
| 10114 | 0.005 |
| 10115 | 0.004 |
| 10116 | 0.007 |
| 10117 | 0.004 |
| 10118 | 0.005 |
| 10119 | 0.005 |
| 10120 | 0.007 |
| 10121 | 0.005 |
| 10122 | 0.005 |
| 10123 | 0.004 |
| 10124 | 0.005 |
| 10125 | 0.006 |
| 10126 | 0.003 |
| 10127 | 0.002 |
| 10128 | 0.004 |
| 10129 | 0.008 |
| 10130 | 0.003 |
| 10131 | 0.004 |
| 10132 | 0.004 |
| 10133 | 0.005 |
| 10134 | 0.003 |
| 10135 | 0.006 |
| 10136 | 0.012 |
| 10137 | 0.008 |
| 10138 | 0.004 |
| 10139 | 0.006 |
| 10140 | 0.005 |
| 10141 | 0.005 |
| 10142 | 0.005 |
| 10143 | 0.004 |
| 10144 | 0.007 |
| 10145 | 0.004 |
| 10146 | 0.007 |
| 10147 | 0.005 |
| 10148 | 0.009 |
| 10149 | 0.002 |
| 10150 | 0.003 |
| 10151 | 0.007 |
| 10152 | 0.005 |
| 10153 | 0.004 |
| 10154 | 0.004 |
| 10155 | 0.004 |
| 10156 | 0.004 |
| 10157 | 0.003 |
| 10158 | 0.003 |
| 10159 | 0.004 |
| 10160 | 0.002 |
| 10161 | 0.005 |
| 10162 | 0.004 |
| 10163 | 0.004 |
| 10164 | 0.003 |
| 10165 | 0.01 |
| 10166 | 0.003 |
| 10167 | 0.002 |
| 10168 | 0.004 |
| 10169 | 0.005 |
| 10170 | 0.001 |
| 10171 | 0.004 |
| 10172 | 0.006 |
| 10173 | 0.006 |
| 10174 | 0.002 |
| 10175 | 0.001 |
| 10176 | 0.001 |
| 10177 | 0.003 |
| 10178 | 0.001 |
| 10179 | 0.005 |
| 10180 | 0.008 |
| 10181 | 0.004 |
| 10182 | 0.008 |
| 10183 | 0.003 |
| 10184 | 0.006 |
| 10185 | 0.006 |
| 10186 | 0.004 |
| 10187 | 0.004 |
| 10188 | 0.002 |
| 10189 | 0.009 |
| 10190 | 0.004 |
| 10191 | 0.002 |
| 10192 | 0.005 |
| 10193 | 0.003 |
| 10194 | 0.005 |
| 10195 | 0.003 |
| 10196 | 0.003 |
| 10197 | 0.004 |
| 10198 | 0.005 |
| 10199 | 0.003 |
| 10200 | 0.003 |
| 10201 | 0.001 |
| 10202 | 0.004 |
| 10203 | 0.005 |
| 10204 | 0.003 |
| 10205 | 0.002 |
| 10206 | 0.002 |
| 10207 | 0.005 |
| 10208 | 0.004 |
| 10209 | 0.006 |
| 10210 | 0.004 |
| 10211 | 0.003 |
| 10212 | 0.006 |
| 10213 | 0.011 |
| 10214 | 0.001 |
| 10215 | 0.001 |
| 10216 | 0.005 |
| 10217 | 0.011 |
| 10218 | 0.003 |
| 10219 | 0.003 |
| 10220 | 0.002 |
| 10221 | 0.004 |
| 10222 | 0.003 |
| 10223 | 0.006 |
| 10224 | 0.001 |
| 10225 | 0.005 |
| 10226 | 0.001 |
| 10227 | 0.001 |
| 10228 | 0.004 |
| 10229 | 0.001 |
| 10230 | 0.001 |
| 10231 | 0.002 |
| 10232 | 0.001 |
| 10233 | 0.001 |
| 10234 | 0.002 |
| 10235 | 0.005 |
| 10236 | 0.006 |
| 10237 | 0.002 |
| 10238 | 0.004 |
| 10239 | 0.005 |
| 10240 | 0.006 |
| 10241 | 0.003 |
| 10242 | 0.004 |
| 10243 | 0.003 |
| 10244 | 0.005 |
| 10245 | 0.001 |
| 10246 | 0.002 |
| 10247 | 0.01 |
| 10248 | 0.004 |
| 10249 | 0.004 |
| 10250 | 0.005 |
| 10251 | 0.003 |
| 10252 | 0.004 |
| 10253 | 0.004 |
| 10254 | 0.006 |
| 10255 | 0.006 |
| 10256 | 0.006 |
| 10257 | 0.004 |
| 10258 | 0.003 |
| 10259 | 0.005 |
| 10260 | 0.006 |
| 10261 | 0.004 |
| 10262 | 0.006 |
| 10263 | 0.007 |
| 10264 | 0.003 |
| 10265 | 0.002 |
| 10266 | 0.004 |
| 10267 | 0.001 |
| 10268 | 0.004 |
| 10269 | 0.006 |
| 10270 | 0.004 |
| 10271 | 0.005 |
| 10272 | 0.006 |
| 10273 | 0.004 |
| 10274 | 0.006 |
| 10275 | 0.006 |
| 10276 | 0.006 |
| 10277 | 0.003 |
| 10278 | 0.006 |
| 10279 | 0.005 |
| 10280 | 0.002 |
| 10281 | 0.004 |
| 10282 | 0.003 |
| 10283 | 0.005 |
| 10284 | 0.005 |
| 10285 | 0.002 |
| 10286 | 0.003 |
| 10287 | 0.004 |
| 10288 | 0.005 |
| 10289 | 0.006 |
| 10290 | 0.002 |
| 10291 | 0.003 |
| 10292 | 0.007 |
| 10293 | 0.003 |
| 10294 | 0.004 |
| 10295 | 0.004 |
| 10296 | 0.003 |
| 10297 | 0.005 |
| 10298 | 0.008 |
| 10299 | 0.013 |
| 10300 | 0.002 |
| 10301 | 0.004 |
| 10302 | 0.003 |
| 10303 | 0.003 |
| 10304 | 0.003 |
| 10305 | 0.004 |
| 10306 | 0.007 |
| 10307 | 0.005 |
| 10308 | 0.003 |
| 10309 | 0.003 |
| 10310 | 0.005 |
| 10311 | 0.003 |
| 10312 | 0.007 |
| 10313 | 0.006 |
| 10314 | 0.003 |
| 10315 | 0.001 |
| 10316 | 0.002 |
| 10317 | 0.003 |
| 10318 | 0.002 |
| 10319 | 0.004 |
| 10320 | 0.005 |
| 10321 | 0.005 |
| 10322 | 0.006 |
| 10323 | 0.004 |
| 10324 | 0.003 |
| 10325 | 0.003 |
| 10326 | 0.004 |
| 10327 | 0.005 |
| 10328 | 0.008 |
| 10329 | 0.01 |
| 10330 | 0.004 |
| 10331 | 0.003 |
| 10332 | 0.003 |
| 10333 | 0.007 |
| 10334 | 0.002 |
| 10335 | 0.005 |
| 10336 | 0.003 |
| 10337 | 0.005 |
| 10338 | 0.002 |
| 10339 | 0.002 |
| 10340 | 0.002 |
| 10341 | 0.004 |
| 10342 | 0.003 |
| 10343 | 0.008 |
| 10344 | 0.012 |
| 10345 | 0.007 |
| 10346 | 0.004 |
| 10347 | 0.003 |
| 10348 | 0.003 |
| 10349 | 0.005 |
| 10350 | 0.007 |
| 10351 | 0.005 |
| 10352 | 0.006 |
| 10353 | 0.003 |
| 10354 | 0.005 |
| 10355 | 0.006 |
| 10356 | 0.006 |
| 10357 | 0.006 |
| 10358 | 0.005 |
| 10359 | 0.007 |
| 10360 | 0.009 |
| 10361 | 0.002 |
| 10362 | 0.003 |
| 10363 | 0.008 |
| 10364 | 0.007 |
| 10365 | 0.006 |
| 10366 | 0.003 |
| 10367 | 0.004 |
| 10368 | 0.011 |
| 10369 | 0.004 |
| 10370 | 0.003 |
| 10371 | 0.006 |
| 10372 | 0.001 |
| 10373 | 0.001 |
| 10374 | 0.002 |
| 10375 | 0.004 |
| 10376 | 0.005 |
| 10377 | 0.003 |
| 10378 | 0.004 |
| 10379 | 0.005 |
| 10380 | 0.004 |
| 10381 | 0.003 |
| 10382 | 0.002 |
| 10383 | 0.004 |
| 10384 | 0.002 |
| 10385 | 0.011 |
| 10386 | 0.003 |
| 10387 | 0.004 |
| 10388 | 0.003 |
| 10389 | 0.004 |
| 10390 | 0.001 |
| 10391 | 0.003 |
| 10392 | 0.005 |
| 10393 | 0.007 |
| 10394 | 0.005 |
| 10395 | 0.002 |
| 10396 | 0.012 |
| 10397 | 0.003 |
| 10398 | 0.005 |
| 10399 | 0.007 |
| 10400 | 0.004 |
| 10401 | 0.005 |
| 10402 | 0.004 |
| 10403 | 0.006 |
| 10404 | 0.008 |
| 10405 | 0.003 |
| 10406 | 0.001 |
| 10407 | 0.005 |
| 10408 | 0.006 |
| 10409 | 0.003 |
| 10410 | 0.004 |
| 10411 | 0.006 |
| 10412 | 0.006 |
| 10413 | 0.005 |
| 10414 | 0.002 |
| 10415 | 0.001 |
| 10416 | 0.003 |
| 10417 | 0.006 |
| 10418 | 0.003 |
| 10419 | 0.005 |
| 10420 | 0.005 |
| 10421 | 0.003 |
| 10422 | 0.004 |
| 10423 | 0.003 |
| 10424 | 0.003 |
| 10425 | 0.001 |
| 10426 | 0.002 |
| 10427 | 0.003 |
| 10428 | 0.006 |
| 10429 | 0.009 |
| 10430 | 0.004 |
| 10431 | 0.003 |
| 10432 | 0.004 |
| 10433 | 0.003 |
| 10434 | 0.004 |
| 10435 | 0.008 |
| 10436 | 0.009 |
| 10437 | 0.006 |
| 10438 | 0.002 |
| 10439 | 0.004 |
| 10440 | 0.004 |
| 10441 | 0.009 |
| 10442 | 0.002 |
| 10443 | 0.003 |
| 10444 | 0.002 |
| 10445 | 0.006 |
| 10446 | 0.002 |
| 10447 | 0.006 |
| 10448 | 0.004 |
| 10449 | 0.002 |
| 10450 | 0.003 |
| 10451 | 0.003 |
| 10452 | 0.003 |
| 10453 | 0.004 |
| 10454 | 0.008 |
| 10455 | 0.007 |
| 10456 | 0.001 |
| 10457 | 0.003 |
| 10458 | 0.002 |
| 10459 | 0.005 |
| 10460 | 0.003 |
| 10461 | 0.003 |
| 10462 | 0.004 |
| 10463 | 0.005 |
| 10464 | 0.008 |
| 10465 | 0.006 |
| 10466 | 0.003 |
| 10467 | 0.004 |
| 10468 | 0.008 |
| 10469 | 0.007 |
| 10470 | 0.003 |
| 10471 | 0.002 |
| 10472 | 0.006 |
| 10473 | 0.004 |
| 10474 | 0.002 |
| 10475 | 0.001 |
| 10476 | 0.004 |
| 10477 | 0.006 |
| 10478 | 0.001 |
| 10479 | 0.002 |
| 10480 | 0.002 |
| 10481 | 0.004 |
| 10482 | 0.003 |
| 10483 | 0.003 |
| 10484 | 0.002 |
| 10485 | 0.003 |
| 10486 | 0.005 |
| 10487 | 0.01 |
| 10488 | 0.005 |
| 10489 | 0.004 |
| 10490 | 0.006 |
| 10491 | 0.002 |
| 10492 | 0.007 |
| 10493 | 0.002 |
| 10494 | 0.006 |
| 10495 | 0.006 |
| 10496 | 0.003 |
| 10497 | 0.002 |
| 10498 | 0.005 |
| 10499 | 0.002 |
| 10500 | 0.004 |
| 10501 | 0.003 |
| 10502 | 0 |
| 10503 | 0.001 |
| 10504 | 0.005 |
| 10505 | 0.001 |
| 10506 | 0.003 |
| 10507 | 0.002 |
| 10508 | 0.006 |
| 10509 | 0.003 |
| 10510 | 0.005 |
| 10511 | 0.008 |
| 10512 | 0.008 |
| 10513 | 0.004 |
| 10514 | 0.002 |
| 10515 | 0.004 |
| 10516 | 0.004 |
| 10517 | 0.005 |
| 10518 | 0.002 |
| 10519 | 0.004 |
| 10520 | 0.007 |
| 10521 | 0.003 |
| 10522 | 0.003 |
| 10523 | 0.005 |
| 10524 | 0.007 |
| 10525 | 0.009 |
| 10526 | 0.012 |
| 10527 | 0.003 |
| 10528 | 0.005 |
| 10529 | 0.001 |
| 10530 | 0.003 |
| 10531 | 0.005 |
| 10532 | 0.007 |
| 10533 | 0.003 |
| 10534 | 0.002 |
| 10535 | 0.002 |
| 10536 | 0.006 |
| 10537 | 0.002 |
| 10538 | 0.004 |
| 10539 | 0.002 |
| 10540 | 0.005 |
| 10541 | 0.003 |
| 10542 | 0.004 |
| 10543 | 0.002 |
| 10544 | 0.002 |
| 10545 | 0.001 |
| 10546 | 0.007 |
| 10547 | 0.006 |
| 10548 | 0.003 |
| 10549 | 0.004 |
| 10550 | 0.003 |
| 10551 | 0.001 |
| 10552 | 0.005 |
| 10553 | 0.005 |
| 10554 | 0.008 |
| 10555 | 0.007 |
| 10556 | 0.004 |
| 10557 | 0.003 |
| 10558 | 0.002 |
| 10559 | 0.002 |
| 10560 | 0.008 |
| 10561 | 0.009 |
| 10562 | 0.008 |
| 10563 | 0.003 |
| 10564 | 0.005 |
| 10565 | 0.005 |
| 10566 | 0.002 |
| 10567 | 0.004 |
| 10568 | 0.002 |
| 10569 | 0.006 |
| 10570 | 0.005 |
| 10571 | 0.006 |
| 10572 | 0.006 |
| 10573 | 0.007 |
| 10574 | 0.003 |
| 10575 | 0.004 |
| 10576 | 0.011 |
| 10577 | 0.006 |
| 10578 | 0.008 |
| 10579 | 0.007 |
| 10580 | 0.002 |
| 10581 | 0.003 |
| 10582 | 0.009 |
| 10583 | 0.007 |
| 10584 | 0.005 |
| 10585 | 0.005 |
| 10586 | 0.006 |
| 10587 | 0.005 |
| 10588 | 0.004 |
| 10589 | 0.004 |
| 10590 | 0.005 |
| 10591 | 0.004 |
| 10592 | 0.005 |
| 10593 | 0.001 |
| 10594 | 0.006 |
| 10595 | 0.005 |
| 10596 | 0.007 |
| 10597 | 0.006 |
| 10598 | 0.004 |
| 10599 | 0.005 |
| 10600 | 0.005 |
| 10601 | 0.003 |
| 10602 | 0.009 |
| 10603 | 0.008 |
| 10604 | 0.004 |
| 10605 | 0.001 |
| 10606 | 0.003 |
| 10607 | 0.003 |
| 10608 | 0.003 |
| 10609 | 0.006 |
| 10610 | 0.004 |
| 10611 | 0.006 |
| 10612 | 0.005 |
| 10613 | 0.003 |
| 10614 | 0.003 |
| 10615 | 0.004 |
| 10616 | 0.002 |
| 10617 | 0.003 |
| 10618 | 0.004 |
| 10619 | 0.007 |
| 10620 | 0.005 |
| 10621 | 0.005 |
| 10622 | 0.006 |
| 10623 | 0.003 |
| 10624 | 0.008 |
| 10625 | 0.003 |
| 10626 | 0.004 |
| 10627 | 0.004 |
| 10628 | 0.005 |
| 10629 | 0.002 |
| 10630 | 0.003 |
| 10631 | 0.008 |
| 10632 | 0.005 |
| 10633 | 0.002 |
| 10634 | 0.003 |
| 10635 | 0.004 |
| 10636 | 0.004 |
| 10637 | 0.002 |
| 10638 | 0.001 |
| 10639 | 0.002 |
| 10640 | 0.008 |
| 10641 | 0.002 |
| 10642 | 0.001 |
| 10643 | 0.003 |
| 10644 | 0.01 |
| 10645 | 0.002 |
| 10646 | 0.003 |
| 10647 | 0.001 |
| 10648 | 0.001 |
| 10649 | 0.002 |
| 10650 | 0.003 |
| 10651 | 0.004 |
| 10652 | 0.003 |
| 10653 | 0.007 |
| 10654 | 0.002 |
| 10655 | 0.005 |
| 10656 | 0.004 |
| 10657 | 0.003 |
| 10658 | 0.003 |
| 10659 | 0.004 |
| 10660 | 0.007 |
| 10661 | 0.001 |
| 10662 | 0.002 |
| 10663 | 0.001 |
| 10664 | 0.004 |
| 10665 | 0.003 |
| 10666 | 0.004 |
| 10667 | 0.003 |
| 10668 | 0.004 |
| 10669 | 0.002 |
| 10670 | 0.002 |
| 10671 | 0.002 |
| 10672 | 0.008 |
| 10673 | 0.003 |
| 10674 | 0.004 |
| 10675 | 0.003 |
| 10676 | 0.004 |
| 10677 | 0.003 |
| 10678 | 0.001 |
| 10679 | 0.002 |
| 10680 | 0.004 |
| 10681 | 0.006 |
| 10682 | 0.003 |
| 10683 | 0.003 |
| 10684 | 0.003 |
| 10685 | 0.005 |
| 10686 | 0.005 |
| 10687 | 0.001 |
| 10688 | 0.004 |
| 10689 | 0.004 |
| 10690 | 0.004 |
| 10691 | 0.003 |
| 10692 | 0.002 |
| 10693 | 0.007 |
| 10694 | 0.002 |
| 10695 | 0.003 |
| 10696 | 0.003 |
| 10697 | 0.006 |
| 10698 | 0.001 |
| 10699 | 0.002 |
| 10700 | 0.001 |
| 10701 | 0.005 |
| 10702 | 0.003 |
| 10703 | 0.003 |
| 10704 | 0.006 |
| 10705 | 0.005 |
| 10706 | 0.002 |
| 10707 | 0.002 |
| 10708 | 0.004 |
| 10709 | 0.006 |
| 10710 | 0.003 |
| 10711 | 0.003 |
| 10712 | 0.003 |
| 10713 | 0.005 |
| 10714 | 0.005 |
| 10715 | 0.003 |
| 10716 | 0.004 |
| 10717 | 0.006 |
| 10718 | 0.003 |
| 10719 | 0.004 |
| 10720 | 0.002 |
| 10721 | 0.003 |
| 10722 | 0.005 |
| 10723 | 0.006 |
| 10724 | 0.006 |
| 10725 | 0.004 |
| 10726 | 0.002 |
| 10727 | 0.002 |
| 10728 | 0.004 |
| 10729 | 0.004 |
| 10730 | 0.003 |
| 10731 | 0.003 |
| 10732 | 0.002 |
| 10733 | 0.002 |
| 10734 | 0.001 |
| 10735 | 0.004 |
| 10736 | 0.005 |
| 10737 | 0.003 |
| 10738 | 0.005 |
| 10739 | 0.005 |
| 10740 | 0.007 |
| 10741 | 0.007 |
| 10742 | 0.001 |
| 10743 | 0.004 |
| 10744 | 0.007 |
| 10745 | 0.005 |
| 10746 | 0.003 |
| 10747 | 0.004 |
| 10748 | 0.004 |
| 10749 | 0.006 |
| 10750 | 0.006 |
| 10751 | 0.004 |
| 10752 | 0.005 |
| 10753 | 0.005 |
| 10754 | 0.002 |
| 10755 | 0.001 |
| 10756 | 0.005 |
| 10757 | 0.006 |
| 10758 | 0.002 |
| 10759 | 0.002 |
| 10760 | 0.003 |
| 10761 | 0.005 |
| 10762 | 0.003 |
| 10763 | 0.002 |
| 10764 | 0.003 |
| 10765 | 0.012 |
| 10766 | 0.004 |
| 10767 | 0.007 |
| 10768 | 0.01 |
| 10769 | 0.01 |
| 10770 | 0.001 |
| 10771 | 0.002 |
| 10772 | 0.009 |
| 10773 | 0.003 |
| 10774 | 0.003 |
| 10775 | 0.004 |
| 10776 | 0.003 |
| 10777 | 0.004 |
| 10778 | 0.003 |
| 10779 | 0.002 |
| 10780 | 0.005 |
| 10781 | 0.003 |
| 10782 | 0.001 |
| 10783 | 0.002 |
| 10784 | 0.005 |
| 10785 | 0.004 |
| 10786 | 0.003 |
| 10787 | 0.004 |
| 10788 | 0.006 |
| 10789 | 0.002 |
| 10790 | 0.001 |
| 10791 | 0.004 |
| 10792 | 0.005 |
| 10793 | 0.007 |
| 10794 | 0.005 |
| 10795 | 0.002 |
| 10796 | 0.002 |
| 10797 | 0.004 |
| 10798 | 0.001 |
| 10799 | 0.003 |
| 10800 | 0.005 |
| 10801 | 0.004 |
| 10802 | 0.002 |
| 10803 | 0.003 |
| 10804 | 0.007 |
| 10805 | 0.011 |
| 10806 | 0.002 |
| 10807 | 0.002 |
| 10808 | 0.006 |
| 10809 | 0.007 |
| 10810 | 0.002 |
| 10811 | 0.006 |
| 10812 | 0.008 |
| 10813 | 0.006 |
| 10814 | 0.003 |
| 10815 | 0.006 |
| 10816 | 0.003 |
| 10817 | 0.004 |
| 10818 | 0.002 |
| 10819 | 0.002 |
| 10820 | 0.002 |
| 10821 | 0.003 |
| 10822 | 0.002 |
| 10823 | 0.004 |
| 10824 | 0.001 |
| 10825 | 0.003 |
| 10826 | 0.005 |
| 10827 | 0.005 |
| 10828 | 0.005 |
| 10829 | 0.006 |
| 10830 | 0.001 |
| 10831 | 0.003 |
| 10832 | 0.001 |
| 10833 | 0.003 |
| 10834 | 0.002 |
| 10835 | 0.002 |
| 10836 | 0.005 |
| 10837 | 0.003 |
| 10838 | 0.005 |
| 10839 | 0.002 |
| 10840 | 0.008 |
| 10841 | 0.002 |
| 10842 | 0.004 |
| 10843 | 0.003 |
| 10844 | 0.005 |
| 10845 | 0.001 |
| 10846 | 0.005 |
| 10847 | 0.006 |
| 10848 | 0.002 |
| 10849 | 0.007 |
| 10850 | 0.002 |
| 10851 | 0.003 |
| 10852 | 0.005 |
| 10853 | 0.007 |
| 10854 | 0.005 |
| 10855 | 0.005 |
| 10856 | 0.005 |
| 10857 | 0.011 |
| 10858 | 0.002 |
| 10859 | 0.008 |
| 10860 | 0.005 |
| 10861 | 0.003 |
| 10862 | 0.007 |
| 10863 | 0.002 |
| 10864 | 0.002 |
| 10865 | 0.007 |
| 10866 | 0.011 |
| 10867 | 0.003 |
| 10868 | 0.007 |
| 10869 | 0.006 |
| 10870 | 0.003 |
| 10871 | 0.002 |
| 10872 | 0.004 |
| 10873 | 0.004 |
| 10874 | 0.003 |
| 10875 | 0.007 |
| 10876 | 0.005 |
| 10877 | 0.001 |
| 10878 | 0.002 |
| 10879 | 0.005 |
| 10880 | 0.005 |
| 10881 | 0.005 |
| 10882 | 0.002 |
| 10883 | 0.003 |
| 10884 | 0.002 |
| 10885 | 0.01 |
| 10886 | 0.005 |
| 10887 | 0.005 |
| 10888 | 0.004 |
| 10889 | 0.008 |
| 10890 | 0.01 |
| 10891 | 0.01 |
| 10892 | 0.011 |
| 10893 | 0.004 |
| 10894 | 0.002 |
| 10895 | 0.003 |
| 10896 | 0.004 |
| 10897 | 0.004 |
| 10898 | 0.005 |
| 10899 | 0.001 |
| 10900 | 0.003 |
| 10901 | 0.002 |
| 10902 | 0.004 |
| 10903 | 0.014 |
| 10904 | 0.006 |
| 10905 | 0.001 |
| 10906 | 0.003 |
| 10907 | 0.002 |
| 10908 | 0.004 |
| 10909 | 0.006 |
| 10910 | 0.003 |
| 10911 | 0.005 |
| 10912 | 0.007 |
| 10913 | 0.003 |
| 10914 | 0.003 |
| 10915 | 0.006 |
| 10916 | 0.011 |
| 10917 | 0.002 |
| 10918 | 0.007 |
| 10919 | 0.004 |
| 10920 | 0.004 |
| 10921 | 0.002 |
| 10922 | 0.003 |
| 10923 | 0.006 |
| 10924 | 0.003 |
| 10925 | 0.002 |
| 10926 | 0.004 |
| 10927 | 0.004 |
| 10928 | 0.01 |
| 10929 | 0.003 |
| 10930 | 0.002 |
| 10931 | 0.008 |
| 10932 | 0.006 |
| 10933 | 0.001 |
| 10934 | 0.002 |
| 10935 | 0.002 |
| 10936 | 0.002 |
| 10937 | 0.004 |
| 10938 | 0.002 |
| 10939 | 0.008 |
| 10940 | 0.008 |
| 10941 | 0.002 |
| 10942 | 0.004 |
| 10943 | 0.007 |
| 10944 | 0.011 |
| 10945 | 0.003 |
| 10946 | 0.003 |
| 10947 | 0.003 |
| 10948 | 0.005 |
| 10949 | 0.002 |
| 10950 | 0.004 |
| 10951 | 0.007 |
| 10952 | 0.005 |
| 10953 | 0.004 |
| 10954 | 0.006 |
| 10955 | 0.003 |
| 10956 | 0.002 |
| 10957 | 0.001 |
| 10958 | 0.003 |
| 10959 | 0.005 |
| 10960 | 0.006 |
| 10961 | 0.005 |
| 10962 | 0.002 |
| 10963 | 0.004 |
| 10964 | 0.002 |
| 10965 | 0.001 |
| 10966 | 0.002 |
| 10967 | 0.005 |
| 10968 | 0.004 |
| 10969 | 0.003 |
| 10970 | 0.002 |
| 10971 | 0.006 |
| 10972 | 0.004 |
| 10973 | 0.005 |
| 10974 | 0.008 |
| 10975 | 0.007 |
| 10976 | 0.008 |
| 10977 | 0.002 |
| 10978 | 0.002 |
| 10979 | 0.002 |
| 10980 | 0.007 |
| 10981 | 0.002 |
| 10982 | 0.004 |
| 10983 | 0.005 |
| 10984 | 0.006 |
| 10985 | 0.002 |
| 10986 | 0.001 |
| 10987 | 0.01 |
| 10988 | 0.005 |
| 10989 | 0.002 |
| 10990 | 0.007 |
| 10991 | 0.007 |
| 10992 | 0.004 |
| 10993 | 0.002 |
| 10994 | 0.004 |
| 10995 | 0.003 |
| 10996 | 0.004 |
| 10997 | 0.002 |
| 10998 | 0.009 |
| 10999 | 0.008 |
| 11000 | 0.004 |
| 11001 | 0.003 |
| 11002 | 0.004 |
| 11003 | 0.003 |
| 11004 | 0.002 |
| 11005 | 0.004 |
| 11006 | 0.003 |
| 11007 | 0.005 |
| 11008 | 0.005 |
| 11009 | 0.004 |
| 11010 | 0.002 |
| 11011 | 0.004 |
| 11012 | 0.004 |
| 11013 | 0.003 |
| 11014 | 0.003 |
| 11015 | 0.006 |
| 11016 | 0.004 |
| 11017 | 0.003 |
| 11018 | 0.004 |
| 11019 | 0.004 |
| 11020 | 0.009 |
| 11021 | 0.002 |
| 11022 | 0.005 |
| 11023 | 0.008 |
| 11024 | 0.003 |
| 11025 | 0.002 |
| 11026 | 0.001 |
| 11027 | 0.002 |
| 11028 | 0.003 |
| 11029 | 0.005 |
| 11030 | 0.002 |
| 11031 | 0.005 |
| 11032 | 0.008 |
| 11033 | 0.007 |
| 11034 | 0.004 |
| 11035 | 0.004 |
| 11036 | 0.005 |
| 11037 | 0.007 |
| 11038 | 0.004 |
| 11039 | 0.005 |
| 11040 | 0.008 |
| 11041 | 0.003 |
| 11042 | 0.004 |
| 11043 | 0.006 |
| 11044 | 0.007 |
| 11045 | 0.01 |
| 11046 | 0.002 |
| 11047 | 0.001 |
| 11048 | 0.003 |
| 11049 | 0.006 |
| 11050 | 0.003 |
| 11051 | 0.004 |
| 11052 | 0.003 |
| 11053 | 0.008 |
| 11054 | 0.005 |
| 11055 | 0.003 |
| 11056 | 0.006 |
| 11057 | 0.006 |
| 11058 | 0.003 |
| 11059 | 0.004 |
| 11060 | 0.004 |
| 11061 | 0.003 |
| 11062 | 0.002 |
| 11063 | 0.003 |
| 11064 | 0.003 |
| 11065 | 0.004 |
| 11066 | 0.002 |
| 11067 | 0.003 |
| 11068 | 0.007 |
| 11069 | 0.007 |
| 11070 | 0.002 |
| 11071 | 0.002 |
| 11072 | 0.003 |
| 11073 | 0.009 |
| 11074 | 0.001 |
| 11075 | 0.002 |
| 11076 | 0.004 |
| 11077 | 0.007 |
| 11078 | 0.001 |
| 11079 | 0.002 |
| 11080 | 0.004 |
| 11081 | 0.002 |
| 11082 | 0.003 |
| 11083 | 0.003 |
| 11084 | 0.007 |
| 11085 | 0.003 |
| 11086 | 0.004 |
| 11087 | 0.002 |
| 11088 | 0.003 |
| 11089 | 0.004 |
| 11090 | 0.004 |
| 11091 | 0.004 |
| 11092 | 0.003 |
| 11093 | 0.005 |
| 11094 | 0.008 |
| 11095 | 0.006 |
| 11096 | 0.007 |
| 11097 | 0.001 |
| 11098 | 0.004 |
| 11099 | 0.002 |
| 11100 | 0.003 |
| 11101 | 0.004 |
| 11102 | 0.005 |
| 11103 | 0.001 |
| 11104 | 0.005 |
| 11105 | 0.005 |
| 11106 | 0.001 |
| 11107 | 0.002 |
| 11108 | 0.001 |
| 11109 | 0.002 |
| 11110 | 0.006 |
| 11111 | 0.004 |
| 11112 | 0.009 |
| 11113 | 0.012 |
| 11114 | 0.005 |
| 11115 | 0.003 |
| 11116 | 0.008 |
| 11117 | 0.009 |
| 11118 | 0.002 |
| 11119 | 0.002 |
| 11120 | 0.01 |
| 11121 | 0.01 |
| 11122 | 0.002 |
| 11123 | 0.005 |
| 11124 | 0.008 |
| 11125 | 0.001 |
| 11126 | 0.007 |
| 11127 | 0.001 |
| 11128 | 0.003 |
| 11129 | 0.003 |
| 11130 | 0.006 |
| 11131 | 0.005 |
| 11132 | 0.001 |
| 11133 | 0.002 |
| 11134 | 0.007 |
| 11135 | 0.003 |
| 11136 | 0.007 |
| 11137 | 0.001 |
| 11138 | 0.002 |
| 11139 | 0.003 |
| 11140 | 0.004 |
| 11141 | 0.004 |
| 11142 | 0.001 |
| 11143 | 0.004 |
| 11144 | 0.002 |
| 11145 | 0.001 |
| 11146 | 0.003 |
| 11147 | 0.004 |
| 11148 | 0.003 |
| 11149 | 0.002 |
| 11150 | 0.006 |
| 11151 | 0.003 |
| 11152 | 0.004 |
| 11153 | 0.004 |
| 11154 | 0.001 |
| 11155 | 0.003 |
| 11156 | 0.003 |
| 11157 | 0.008 |
| 11158 | 0.006 |
| 11159 | 0.004 |
| 11160 | 0.002 |
| 11161 | 0.008 |
| 11162 | 0.004 |
| 11163 | 0.004 |
| 11164 | 0.006 |
| 11165 | 0.005 |
| 11166 | 0.009 |
| 11167 | 0.004 |
| 11168 | 0.005 |
| 11169 | 0.006 |
| 11170 | 0.009 |
| 11171 | 0.002 |
| 11172 | 0.003 |
| 11173 | 0.005 |
| 11174 | 0.002 |
| 11175 | 0.003 |
| 11176 | 0.004 |
| 11177 | 0.006 |
| 11178 | 0.007 |
| 11179 | 0.001 |
| 11180 | 0.006 |
| 11181 | 0.005 |
| 11182 | 0.006 |
| 11183 | 0.002 |
| 11184 | 0.004 |
| 11185 | 0.008 |
| 11186 | 0.009 |
| 11187 | 0.004 |
| 11188 | 0.003 |
| 11189 | 0.003 |
| 11190 | 0.003 |
| 11191 | 0.003 |
| 11192 | 0.009 |
| 11193 | 0.007 |
| 11194 | 0.003 |
| 11195 | 0.003 |
| 11196 | 0.01 |
| 11197 | 0.005 |
| 11198 | 0.004 |
| 11199 | 0.008 |
| 11200 | 0.007 |
| 11201 | 0.008 |
| 11202 | 0.005 |
| 11203 | 0.002 |
| 11204 | 0.003 |
| 11205 | 0.006 |
| 11206 | 0.005 |
| 11207 | 0.004 |
| 11208 | 0.003 |
| 11209 | 0.004 |
| 11210 | 0.002 |
| 11211 | 0.005 |
| 11212 | 0.009 |
| 11213 | 0.006 |
| 11214 | 0.003 |
| 11215 | 0.005 |
| 11216 | 0.009 |
| 11217 | 0.007 |
| 11218 | 0.001 |
| 11219 | 0.002 |
| 11220 | 0.009 |
| 11221 | 0.003 |
| 11222 | 0.002 |
| 11223 | 0.003 |
| 11224 | 0.008 |
| 11225 | 0.005 |
| 11226 | 0.002 |
| 11227 | 0.003 |
| 11228 | 0.003 |
| 11229 | 0.006 |
| 11230 | 0.001 |
| 11231 | 0.002 |
| 11232 | 0.004 |
| 11233 | 0.005 |
| 11234 | 0.004 |
| 11235 | 0.007 |
| 11236 | 0.008 |
| 11237 | 0.002 |
| 11238 | 0.004 |
| 11239 | 0.007 |
| 11240 | 0.004 |
| 11241 | 0.003 |
| 11242 | 0.005 |
| 11243 | 0.004 |
| 11244 | 0.006 |
| 11245 | 0.003 |
| 11246 | 0.004 |
| 11247 | 0.004 |
| 11248 | 0.008 |
| 11249 | 0.004 |
| 11250 | 0.003 |
| 11251 | 0.004 |
| 11252 | 0.005 |
| 11253 | 0.003 |
| 11254 | 0.003 |
| 11255 | 0.006 |
| 11256 | 0.011 |
| 11257 | 0.003 |
| 11258 | 0.005 |
| 11259 | 0.002 |
| 11260 | 0.002 |
| 11261 | 0.004 |
| 11262 | 0.002 |
| 11263 | 0.002 |
| 11264 | 0.001 |
| 11265 | 0.008 |
| 11266 | 0.002 |
| 11267 | 0.002 |
| 11268 | 0.004 |
| 11269 | 0.008 |
| 11270 | 0.003 |
| 11271 | 0.001 |
| 11272 | 0.006 |
| 11273 | 0.013 |
| 11274 | 0.003 |
| 11275 | 0.006 |
| 11276 | 0.006 |
| 11277 | 0.002 |
| 11278 | 0.002 |
| 11279 | 0.004 |
| 11280 | 0.002 |
| 11281 | 0.005 |
| 11282 | 0.003 |
| 11283 | 0.003 |
| 11284 | 0.004 |
| 11285 | 0.006 |
| 11286 | 0.002 |
| 11287 | 0.004 |
| 11288 | 0.005 |
| 11289 | 0.005 |
| 11290 | 0.002 |
| 11291 | 0.003 |
| 11292 | 0.009 |
| 11293 | 0.006 |
| 11294 | 0.001 |
| 11295 | 0.003 |
| 11296 | 0.004 |
| 11297 | 0.005 |
| 11298 | 0.002 |
| 11299 | 0.004 |
| 11300 | 0.005 |
| 11301 | 0.006 |
| 11302 | 0.003 |
| 11303 | 0.005 |
| 11304 | 0.009 |
| 11305 | 0.007 |
| 11306 | 0.001 |
| 11307 | 0.005 |
| 11308 | 0.009 |
| 11309 | 0.009 |
| 11310 | 0.002 |
| 11311 | 0.007 |
| 11312 | 0.008 |
| 11313 | 0.006 |
| 11314 | 0.005 |
| 11315 | 0.002 |
| 11316 | 0.007 |
| 11317 | 0.008 |
| 11318 | 0.001 |
| 11319 | 0.002 |
| 11320 | 0.011 |
| 11321 | 0.011 |
| 11322 | 0.002 |
| 11323 | 0.005 |
| 11324 | 0.005 |
| 11325 | 0.005 |
| 11326 | 0.003 |
| 11327 | 0.002 |
| 11328 | 0.004 |
| 11329 | 0.003 |
| 11330 | 0.002 |
| 11331 | 0.007 |
| 11332 | 0.004 |
| 11333 | 0.005 |
| 11334 | 0.003 |
| 11335 | 0.005 |
| 11336 | 0.007 |
| 11337 | 0.006 |
| 11338 | 0.003 |
| 11339 | 0.003 |
| 11340 | 0.004 |
| 11341 | 0.005 |
| 11342 | 0.002 |
| 11343 | 0.001 |
| 11344 | 0.003 |
| 11345 | 0.009 |
| 11346 | 0.004 |
| 11347 | 0.003 |
| 11348 | 0.003 |
| 11349 | 0.001 |
| 11350 | 0.005 |
| 11351 | 0.009 |
| 11352 | 0.012 |
| 11353 | 0.009 |
| 11354 | 0.002 |
| 11355 | 0.001 |
| 11356 | 0.006 |
| 11357 | 0.004 |
| 11358 | 0.002 |
| 11359 | 0.005 |
| 11360 | 0.002 |
| 11361 | 0.003 |
| 11362 | 0.008 |
| 11363 | 0.003 |
| 11364 | 0.006 |
| 11365 | 0.006 |
| 11366 | 0.007 |
| 11367 | 0.012 |
| 11368 | 0.005 |
| 11369 | 0.001 |
| 11370 | 0.004 |
| 11371 | 0.003 |
| 11372 | 0.005 |
| 11373 | 0.002 |
| 11374 | 0.002 |
| 11375 | 0.004 |
| 11376 | 0.008 |
| 11377 | 0.004 |
| 11378 | 0.001 |
| 11379 | 0.005 |
| 11380 | 0.004 |
| 11381 | 0.001 |
| 11382 | 0.003 |
| 11383 | 0.005 |
| 11384 | 0.003 |
| 11385 | 0.001 |
| 11386 | 0.003 |
| 11387 | 0.001 |
| 11388 | 0.007 |
| 11389 | 0.002 |
| 11390 | 0.007 |
| 11391 | 0.006 |
| 11392 | 0.001 |
| 11393 | 0.003 |
| 11394 | 0.003 |
| 11395 | 0.009 |
| 11396 | 0.004 |
| 11397 | 0.003 |
| 11398 | 0.002 |
| 11399 | 0.001 |
| 11400 | 0.003 |
| 11401 | 0.01 |
| 11402 | 0.002 |
| 11403 | 0.001 |
| 11404 | 0.001 |
| 11405 | 0.003 |
| 11406 | 0.002 |
| 11407 | 0.002 |
| 11408 | 0.002 |
| 11409 | 0.002 |
| 11410 | 0.001 |
| 11411 | 0.004 |
| 11412 | 0.006 |
| 11413 | 0.006 |
| 11414 | 0.002 |
| 11415 | 0.001 |
| 11416 | 0.003 |
| 11417 | 0.004 |
| 11418 | 0.005 |
| 11419 | 0.004 |
| 11420 | 0.004 |
| 11421 | 0.004 |
| 11422 | 0.008 |
| 11423 | 0.007 |
| 11424 | 0.002 |
| 11425 | 0.012 |
| 11426 | 0.003 |
| 11427 | 0.002 |
| 11428 | 0.006 |
| 11429 | 0.004 |
| 11430 | 0.004 |
| 11431 | 0.004 |
| 11432 | 0.003 |
| 11433 | 0.006 |
| 11434 | 0.009 |
| 11435 | 0.005 |
| 11436 | 0.004 |
| 11437 | 0.002 |
| 11438 | 0.006 |
| 11439 | 0.01 |
| 11440 | 0.007 |
| 11441 | 0.002 |
| 11442 | 0.001 |
| 11443 | 0.001 |
| 11444 | 0.002 |
| 11445 | 0.004 |
| 11446 | 0.001 |
| 11447 | 0.002 |
| 11448 | 0.002 |
| 11449 | 0.002 |
| 11450 | 0.005 |
| 11451 | 0.005 |
| 11452 | 0.003 |
| 11453 | 0.006 |
| 11454 | 0.005 |
| 11455 | 0.003 |
| 11456 | 0.001 |
| 11457 | 0.002 |
| 11458 | 0.003 |
| 11459 | 0.002 |
| 11460 | 0.009 |
| 11461 | 0 |
| 11462 | 0.003 |
| 11463 | 0.012 |
| 11464 | 0.007 |
| 11465 | 0.008 |
| 11466 | 0.005 |
| 11467 | 0.006 |
| 11468 | 0.006 |
| 11469 | 0.006 |
| 11470 | 0.004 |
| 11471 | 0.004 |
| 11472 | 0.003 |
| 11473 | 0.006 |
| 11474 | 0.005 |
| 11475 | 0.002 |
| 11476 | 0.003 |
| 11477 | 0.004 |
| 11478 | 0.005 |
| 11479 | 0.009 |
| 11480 | 0.006 |
| 11481 | 0.008 |
| 11482 | 0.006 |
| 11483 | 0.005 |
| 11484 | 0.007 |
| 11485 | 0.004 |
| 11486 | 0.006 |
| 11487 | 0.003 |
| 11488 | 0.004 |
| 11489 | 0.003 |
| 11490 | 0.004 |
| 11491 | 0.003 |
| 11492 | 0.008 |
| 11493 | 0.003 |
| 11494 | 0.004 |
| 11495 | 0.011 |
| 11496 | 0.004 |
| 11497 | 0.004 |
| 11498 | 0.002 |
| 11499 | 0.006 |
| 11500 | 0.009 |
| 11501 | 0.001 |
| 11502 | 0.002 |
| 11503 | 0.003 |
| 11504 | 0.001 |
| 11505 | 0.002 |
| 11506 | 0.005 |
| 11507 | 0.005 |
| 11508 | 0.002 |
| 11509 | 0.002 |
| 11510 | 0.006 |
| 11511 | 0.016 |
| 11512 | 0.009 |
| 11513 | 0.003 |
| 11514 | 0.004 |
| 11515 | 0.008 |
| 11516 | 0.007 |
| 11517 | 0.001 |
| 11518 | 0.002 |
| 11519 | 0.005 |
| 11520 | 0.002 |
| 11521 | 0.003 |
| 11522 | 0.003 |
| 11523 | 0.002 |
| 11524 | 0.003 |
| 11525 | 0.004 |
| 11526 | 0.001 |
| 11527 | 0.004 |
| 11528 | 0.007 |
| 11529 | 0.003 |
| 11530 | 0.003 |
| 11531 | 0.008 |
| 11532 | 0.006 |
| 11533 | 0.003 |
| 11534 | 0.001 |
| 11535 | 0.004 |
| 11536 | 0.003 |
| 11537 | 0.003 |
| 11538 | 0.005 |
| 11539 | 0.001 |
| 11540 | 0.005 |
| 11541 | 0.002 |
| 11542 | 0.005 |
| 11543 | 0.003 |
| 11544 | 0.004 |
| 11545 | 0.002 |
| 11546 | 0.003 |
| 11547 | 0.002 |
| 11548 | 0.004 |
| 11549 | 0.002 |
| 11550 | 0.003 |
| 11551 | 0.006 |
| 11552 | 0.01 |
| 11553 | 0.003 |
| 11554 | 0.002 |
| 11555 | 0.006 |
| 11556 | 0.005 |
| 11557 | 0.003 |
| 11558 | 0.003 |
| 11559 | 0.003 |
| 11560 | 0.002 |
| 11561 | 0.001 |
| 11562 | 0.002 |
| 11563 | 0.007 |
| 11564 | 0.007 |
| 11565 | 0.002 |
| 11566 | 0.007 |
| 11567 | 0.004 |
| 11568 | 0.006 |
| 11569 | 0.007 |
| 11570 | 0.002 |
| 11571 | 0.003 |
| 11572 | 0.007 |
| 11573 | 0.005 |
| 11574 | 0.002 |
| 11575 | 0.002 |
| 11576 | 0.004 |
| 11577 | 0.006 |
| 11578 | 0.003 |
| 11579 | 0.002 |
| 11580 | 0.004 |
| 11581 | 0.003 |
| 11582 | 0.003 |
| 11583 | 0.003 |
| 11584 | 0.005 |
| 11585 | 0.006 |
| 11586 | 0.002 |
| 11587 | 0.004 |
| 11588 | 0.006 |
| 11589 | 0.002 |
| 11590 | 0.002 |
| 11591 | 0.002 |
| 11592 | 0.005 |
| 11593 | 0.006 |
| 11594 | 0.003 |
| 11595 | 0.002 |
| 11596 | 0.004 |
| 11597 | 0.001 |
| 11598 | 0.002 |
| 11599 | 0.004 |
| 11600 | 0.005 |
| 11601 | 0.001 |
| 11602 | 0.002 |
| 11603 | 0.008 |
| 11604 | 0.008 |
| 11605 | 0.002 |
| 11606 | 0.002 |
| 11607 | 0.004 |
| 11608 | 0.008 |
| 11609 | 0.003 |
| 11610 | 0.008 |
| 11611 | 0.002 |
| 11612 | 0.008 |
| 11613 | 0.005 |
| 11614 | 0.005 |
| 11615 | 0.006 |
| 11616 | 0.006 |
| 11617 | 0.002 |
| 11618 | 0.006 |
| 11619 | 0.002 |
| 11620 | 0.005 |
| 11621 | 0.002 |
| 11622 | 0.003 |
| 11623 | 0.005 |
| 11624 | 0.005 |
| 11625 | 0.002 |
| 11626 | 0.007 |
| 11627 | 0.008 |
| 11628 | 0.004 |
| 11629 | 0.002 |
| 11630 | 0.001 |
| 11631 | 0.004 |
| 11632 | 0.002 |
| 11633 | 0.001 |
| 11634 | 0.003 |
| 11635 | 0.006 |
| 11636 | 0.002 |
| 11637 | 0.002 |
| 11638 | 0.005 |
| 11639 | 0.002 |
| 11640 | 0.002 |
| 11641 | 0.004 |
| 11642 | 0.005 |
| 11643 | 0.01 |
| 11644 | 0.009 |
| 11645 | 0.002 |
| 11646 | 0.004 |
| 11647 | 0.006 |
| 11648 | 0.003 |
| 11649 | 0.004 |
| 11650 | 0.003 |
| 11651 | 0.003 |
| 11652 | 0.008 |
| 11653 | 0.007 |
| 11654 | 0.003 |
| 11655 | 0.004 |
| 11656 | 0.004 |
| 11657 | 0.001 |
| 11658 | 0.001 |
| 11659 | 0.001 |
| 11660 | 0.006 |
| 11661 | 0.005 |
| 11662 | 0.009 |
| 11663 | 0.01 |
| 11664 | 0.013 |
| 11665 | 0.002 |
| 11666 | 0.007 |
| 11667 | 0.006 |
| 11668 | 0.002 |
| 11669 | 0.004 |
| 11670 | 0.002 |
| 11671 | 0.009 |
| 11672 | 0.01 |
| 11673 | 0.004 |
| 11674 | 0.004 |
| 11675 | 0.005 |
| 11676 | 0.008 |
| 11677 | 0.002 |
| 11678 | 0.004 |
| 11679 | 0.006 |
| 11680 | 0.002 |
| 11681 | 0.003 |
| 11682 | 0.009 |
| 11683 | 0.007 |
| 11684 | 0.002 |
| 11685 | 0.004 |
| 11686 | 0.003 |
| 11687 | 0.004 |
| 11688 | 0.005 |
| 11689 | 0.004 |
| 11690 | 0.003 |
| 11691 | 0.005 |
| 11692 | 0.003 |
| 11693 | 0.004 |
| 11694 | 0.002 |
| 11695 | 0.001 |
| 11696 | 0.003 |
| 11697 | 0.003 |
| 11698 | 0.004 |
| 11699 | 0.003 |
| 11700 | 0.002 |
| 11701 | 0.003 |
| 11702 | 0.006 |
| 11703 | 0.005 |
| 11704 | 0.002 |
| 11705 | 0.002 |
| 11706 | 0.004 |
| 11707 | 0.003 |
| 11708 | 0.005 |
| 11709 | 0.004 |
| 11710 | 0.004 |
| 11711 | 0.007 |
| 11712 | 0.007 |
| 11713 | 0.006 |
| 11714 | 0.003 |
| 11715 | 0.001 |
| 11716 | 0.006 |
| 11717 | 0.007 |
| 11718 | 0.003 |
| 11719 | 0.004 |
| 11720 | 0.003 |
| 11721 | 0.006 |
| 11722 | 0.004 |
| 11723 | 0.01 |
| 11724 | 0.006 |
| 11725 | 0.007 |
| 11726 | 0.003 |
| 11727 | 0.004 |
| 11728 | 0.002 |
| 11729 | 0.004 |
| 11730 | 0.011 |
| 11731 | 0.001 |
| 11732 | 0.003 |
| 11733 | 0.001 |
| 11734 | 0.001 |
| 11735 | 0.002 |
| 11736 | 0.003 |
| 11737 | 0.006 |
| 11738 | 0.01 |
| 11739 | 0.008 |
| 11740 | 0.002 |
| 11741 | 0.011 |
| 11742 | 0.01 |
| 11743 | 0.003 |
| 11744 | 0.003 |
| 11745 | 0.004 |
| 11746 | 0.002 |
| 11747 | 0.006 |
| 11748 | 0.006 |
| 11749 | 0.005 |
| 11750 | 0.006 |
| 11751 | 0.001 |
| 11752 | 0.002 |
| 11753 | 0.004 |
| 11754 | 0.008 |
| 11755 | 0.003 |
| 11756 | 0.005 |
| 11757 | 0.006 |
| 11758 | 0.003 |
| 11759 | 0.005 |
| 11760 | 0.01 |
| 11761 | 0.006 |
| 11762 | 0.005 |
| 11763 | 0.002 |
| 11764 | 0.006 |
| 11765 | 0.004 |
| 11766 | 0.01 |
| 11767 | 0.005 |
| 11768 | 0.004 |
| 11769 | 0.003 |
| 11770 | 0.005 |
| 11771 | 0.003 |
| 11772 | 0.004 |
| 11773 | 0.001 |
| 11774 | 0.001 |
| 11775 | 0.005 |
| 11776 | 0.003 |
| 11777 | 0.004 |
| 11778 | 0.006 |
| 11779 | 0.004 |
| 11780 | 0.007 |
| 11781 | 0.011 |
| 11782 | 0.01 |
| 11783 | 0.005 |
| 11784 | 0.006 |
| 11785 | 0.01 |
| 11786 | 0.006 |
| 11787 | 0.007 |
| 11788 | 0.006 |
| 11789 | 0.004 |
| 11790 | 0.002 |
| 11791 | 0.004 |
| 11792 | 0.002 |
| 11793 | 0.007 |
| 11794 | 0.008 |
| 11795 | 0.007 |
| 11796 | 0.004 |
| 11797 | 0.002 |
| 11798 | 0.005 |
| 11799 | 0.007 |
| 11800 | 0.004 |
| 11801 | 0.004 |
| 11802 | 0.003 |
| 11803 | 0.003 |
| 11804 | 0.002 |
| 11805 | 0.006 |
| 11806 | 0.004 |
| 11807 | 0.007 |
| 11808 | 0.007 |
| 11809 | 0.004 |
| 11810 | 0.007 |
| 11811 | 0.003 |
| 11812 | 0.005 |
| 11813 | 0.007 |
| 11814 | 0.002 |
| 11815 | 0.003 |
| 11816 | 0.005 |
| 11817 | 0.008 |
| 11818 | 0.001 |
| 11819 | 0.001 |
| 11820 | 0.004 |
| 11821 | 0.002 |
| 11822 | 0.005 |
| 11823 | 0.001 |
| 11824 | 0.003 |
| 11825 | 0.012 |
| 11826 | 0.003 |
| 11827 | 0.003 |
| 11828 | 0.003 |
| 11829 | 0.003 |
| 11830 | 0.001 |
| 11831 | 0.002 |
| 11832 | 0.009 |
| 11833 | 0.007 |
| 11834 | 0.002 |
| 11835 | 0.002 |
| 11836 | 0.006 |
| 11837 | 0.008 |
| 11838 | 0.002 |
| 11839 | 0.002 |
| 11840 | 0.006 |
| 11841 | 0.004 |
| 11842 | 0.004 |
| 11843 | 0.005 |
| 11844 | 0.007 |
| 11845 | 0.003 |
| 11846 | 0.001 |
| 11847 | 0.003 |
| 11848 | 0.004 |
| 11849 | 0.004 |
| 11850 | 0.004 |
| 11851 | 0.004 |
| 11852 | 0.007 |
| 11853 | 0.008 |
| 11854 | 0.001 |
| 11855 | 0.003 |
| 11856 | 0.007 |
| 11857 | 0.003 |
| 11858 | 0.002 |
| 11859 | 0.002 |
| 11860 | 0.005 |
| 11861 | 0.003 |
| 11862 | 0.002 |
| 11863 | 0.003 |
| 11864 | 0.002 |
| 11865 | 0.004 |
| 11866 | 0.002 |
| 11867 | 0.004 |
| 11868 | 0.007 |
| 11869 | 0.012 |
| 11870 | 0.003 |
| 11871 | 0.006 |
| 11872 | 0.006 |
| 11873 | 0.003 |
| 11874 | 0.005 |
| 11875 | 0.002 |
| 11876 | 0.004 |
| 11877 | 0.005 |
| 11878 | 0.002 |
| 11879 | 0.003 |
| 11880 | 0.006 |
| 11881 | 0.009 |
| 11882 | 0.003 |
| 11883 | 0.004 |
| 11884 | 0.004 |
| 11885 | 0.005 |
| 11886 | 0.002 |
| 11887 | 0.002 |
| 11888 | 0.001 |
| 11889 | 0.004 |
| 11890 | 0.002 |
| 11891 | 0.003 |
| 11892 | 0.002 |
| 11893 | 0.008 |
| 11894 | 0.002 |
| 11895 | 0.003 |
| 11896 | 0.005 |
| 11897 | 0.005 |
| 11898 | 0.002 |
| 11899 | 0.004 |
| 11900 | 0.004 |
| 11901 | 0.006 |
| 11902 | 0.003 |
| 11903 | 0.004 |
| 11904 | 0.005 |
| 11905 | 0.006 |
| 11906 | 0.003 |
| 11907 | 0.001 |
| 11908 | 0.005 |
| 11909 | 0.002 |
| 11910 | 0.001 |
| 11911 | 0.003 |
| 11912 | 0.007 |
| 11913 | 0.004 |
| 11914 | 0.001 |
| 11915 | 0.002 |
| 11916 | 0.005 |
| 11917 | 0.006 |
| 11918 | 0.001 |
| 11919 | 0.003 |
| 11920 | 0.003 |
| 11921 | 0.004 |
| 11922 | 0.002 |
| 11923 | 0.004 |
| 11924 | 0.002 |
| 11925 | 0.003 |
| 11926 | 0.001 |
| 11927 | 0.005 |
| 11928 | 0.004 |
| 11929 | 0.005 |
| 11930 | 0.001 |
| 11931 | 0.001 |
| 11932 | 0.003 |
| 11933 | 0.003 |
| 11934 | 0.004 |
| 11935 | 0.005 |
| 11936 | 0.01 |
| 11937 | 0.008 |
| 11938 | 0.002 |
| 11939 | 0.006 |
| 11940 | 0.006 |
| 11941 | 0.006 |
| 11942 | 0.004 |
| 11943 | 0.003 |
| 11944 | 0.006 |
| 11945 | 0.002 |
| 11946 | 0.003 |
| 11947 | 0.005 |
| 11948 | 0.008 |
| 11949 | 0.004 |
| 11950 | 0.001 |
| 11951 | 0.006 |
| 11952 | 0.005 |
| 11953 | 0.008 |
| 11954 | 0.004 |
| 11955 | 0.003 |
| 11956 | 0.006 |
| 11957 | 0.004 |
| 11958 | 0.001 |
| 11959 | 0.003 |
| 11960 | 0.003 |
| 11961 | 0.004 |
| 11962 | 0.003 |
| 11963 | 0.004 |
| 11964 | 0.003 |
| 11965 | 0.004 |
| 11966 | 0.003 |
| 11967 | 0.004 |
| 11968 | 0.002 |
| 11969 | 0.003 |
| 11970 | 0.003 |
| 11971 | 0.006 |
| 11972 | 0.012 |
| 11973 | 0.006 |
| 11974 | 0.002 |
| 11975 | 0.004 |
| 11976 | 0.007 |
| 11977 | 0.006 |
| 11978 | 0.003 |
| 11979 | 0.004 |
| 11980 | 0.008 |
| 11981 | 0.005 |
| 11982 | 0.002 |
| 11983 | 0.001 |
| 11984 | 0.005 |
| 11985 | 0.001 |
| 11986 | 0.003 |
| 11987 | 0.004 |
| 11988 | 0.006 |
| 11989 | 0.007 |
| 11990 | 0.002 |
| 11991 | 0.003 |
| 11992 | 0.003 |
| 11993 | 0.003 |
| 11994 | 0.003 |
| 11995 | 0.003 |
| 11996 | 0.002 |
| 11997 | 0.004 |
| 11998 | 0.001 |
| 11999 | 0.006 |
| 12000 | 0.008 |
| 12001 | 0.003 |
| 12002 | 0.001 |
| 12003 | 0.007 |
| 12004 | 0.008 |
| 12005 | 0.006 |
| 12006 | 0.002 |
| 12007 | 0.002 |
| 12008 | 0.008 |
| 12009 | 0.001 |
| 12010 | 0.003 |
| 12011 | 0.002 |
| 12012 | 0.005 |
| 12013 | 0.004 |
| 12014 | 0.001 |
| 12015 | 0.002 |
| 12016 | 0.006 |
| 12017 | 0.016 |
| 12018 | 0.012 |
| 12019 | 0.007 |
| 12020 | 0.005 |
| 12021 | 0.009 |
| 12022 | 0.004 |
| 12023 | 0.002 |
| 12024 | 0.004 |
| 12025 | 0.003 |
| 12026 | 0.004 |
| 12027 | 0.004 |
| 12028 | 0.004 |
| 12029 | 0.01 |
| 12030 | 0.009 |
| 12031 | 0.002 |
| 12032 | 0.005 |
| 12033 | 0.005 |
| 12034 | 0.001 |
| 12035 | 0.011 |
| 12036 | 0.002 |
| 12037 | 0.002 |
| 12038 | 0.004 |
| 12039 | 0.003 |
| 12040 | 0.005 |
| 12041 | 0.007 |
| 12042 | 0.007 |
| 12043 | 0.004 |
| 12044 | 0.008 |
| 12045 | 0.004 |
| 12046 | 0.006 |
| 12047 | 0.007 |
| 12048 | 0.004 |
| 12049 | 0.004 |
| 12050 | 0.007 |
| 12051 | 0.002 |
| 12052 | 0.003 |
| 12053 | 0.003 |
| 12054 | 0.003 |
| 12055 | 0.007 |
| 12056 | 0.006 |
| 12057 | 0.005 |
| 12058 | 0.009 |
| 12059 | 0.002 |
| 12060 | 0.004 |
| 12061 | 0.004 |
| 12062 | 0.006 |
| 12063 | 0.004 |
| 12064 | 0.005 |
| 12065 | 0.003 |
| 12066 | 0.003 |
| 12067 | 0.005 |
| 12068 | 0.005 |
| 12069 | 0.003 |
| 12070 | 0.004 |
| 12071 | 0.003 |
| 12072 | 0.004 |
| 12073 | 0.002 |
| 12074 | 0.002 |
| 12075 | 0.004 |
| 12076 | 0.002 |
| 12077 | 0.006 |
| 12078 | 0.003 |
| 12079 | 0.003 |
| 12080 | 0.007 |
| 12081 | 0.007 |
| 12082 | 0.004 |
| 12083 | 0.004 |
| 12084 | 0.006 |
| 12085 | 0.005 |
| 12086 | 0.003 |
| 12087 | 0.002 |
| 12088 | 0.002 |
| 12089 | 0.006 |
| 12090 | 0.006 |
| 12091 | 0.001 |
| 12092 | 0.001 |
| 12093 | 0.003 |
| 12094 | 0.006 |
| 12095 | 0.005 |
| 12096 | 0.003 |
| 12097 | 0.007 |
| 12098 | 0.004 |
| 12099 | 0.006 |
| 12100 | 0.007 |
| 12101 | 0.008 |
| 12102 | 0.002 |
| 12103 | 0.003 |
| 12104 | 0.003 |
| 12105 | 0.002 |
| 12106 | 0.004 |
| 12107 | 0.002 |
| 12108 | 0.003 |
| 12109 | 0.006 |
| 12110 | 0.004 |
| 12111 | 0.007 |
| 12112 | 0.007 |
| 12113 | 0.002 |
| 12114 | 0.001 |
| 12115 | 0.005 |
| 12116 | 0.007 |
| 12117 | 0.002 |
| 12118 | 0.003 |
| 12119 | 0.007 |
| 12120 | 0.004 |
| 12121 | 0.003 |
| 12122 | 0.005 |
| 12123 | 0.003 |
| 12124 | 0.003 |
| 12125 | 0.002 |
| 12126 | 0.003 |
| 12127 | 0.005 |
| 12128 | 0.003 |
| 12129 | 0.004 |
| 12130 | 0.006 |
| 12131 | 0.003 |
| 12132 | 0.006 |
| 12133 | 0.004 |
| 12134 | 0.003 |
| 12135 | 0.004 |
| 12136 | 0.001 |
| 12137 | 0.001 |
| 12138 | 0.004 |
| 12139 | 0.005 |
| 12140 | 0.006 |
| 12141 | 0.003 |
| 12142 | 0.002 |
| 12143 | 0.005 |
| 12144 | 0.004 |
| 12145 | 0.003 |
| 12146 | 0.004 |
| 12147 | 0.005 |
| 12148 | 0.009 |
| 12149 | 0.002 |
| 12150 | 0.005 |
| 12151 | 0.006 |
| 12152 | 0.002 |
| 12153 | 0.004 |
| 12154 | 0.001 |
| 12155 | 0.003 |
| 12156 | 0.007 |
| 12157 | 0.002 |
| 12158 | 0.006 |
| 12159 | 0.007 |
| 12160 | 0.003 |
| 12161 | 0.002 |
| 12162 | 0.003 |
| 12163 | 0.005 |
| 12164 | 0.002 |
| 12165 | 0.002 |
| 12166 | 0.006 |
| 12167 | 0.01 |
| 12168 | 0.008 |
| 12169 | 0.007 |
| 12170 | 0.006 |
| 12171 | 0.003 |
| 12172 | 0.001 |
| 12173 | 0.007 |
| 12174 | 0.001 |
| 12175 | 0.003 |
| 12176 | 0.008 |
| 12177 | 0.013 |
| 12178 | 0.002 |
| 12179 | 0.002 |
| 12180 | 0.006 |
| 12181 | 0.004 |
| 12182 | 0.005 |
| 12183 | 0.004 |
| 12184 | 0.005 |
| 12185 | 0.014 |
| 12186 | 0.002 |
| 12187 | 0.003 |
| 12188 | 0.006 |
| 12189 | 0.003 |
| 12190 | 0.002 |
| 12191 | 0.006 |
| 12192 | 0.006 |
| 12193 | 0.007 |
| 12194 | 0.002 |
| 12195 | 0.004 |
| 12196 | 0.005 |
| 12197 | 0.005 |
| 12198 | 0.006 |
| 12199 | 0.002 |
| 12200 | 0.002 |
| 12201 | 0.002 |
| 12202 | 0.003 |
| 12203 | 0.004 |
| 12204 | 0.007 |
| 12205 | 0.005 |
| 12206 | 0.001 |
| 12207 | 0.003 |
| 12208 | 0.003 |
| 12209 | 0.005 |
| 12210 | 0.002 |
| 12211 | 0.004 |
| 12212 | 0.003 |
| 12213 | 0.007 |
| 12214 | 0.002 |
| 12215 | 0.002 |
| 12216 | 0.001 |
| 12217 | 0.008 |
| 12218 | 0.003 |
| 12219 | 0.007 |
| 12220 | 0.005 |
| 12221 | 0.004 |
| 12222 | 0.002 |
| 12223 | 0.003 |
| 12224 | 0.006 |
| 12225 | 0.004 |
| 12226 | 0.004 |
| 12227 | 0.005 |
| 12228 | 0.006 |
| 12229 | 0.003 |
| 12230 | 0.005 |
| 12231 | 0.003 |
| 12232 | 0.006 |
| 12233 | 0.003 |
| 12234 | 0.005 |
| 12235 | 0.006 |
| 12236 | 0.006 |
| 12237 | 0.002 |
| 12238 | 0.002 |
| 12239 | 0.009 |
| 12240 | 0.007 |
| 12241 | 0.003 |
| 12242 | 0.003 |
| 12243 | 0.006 |
| 12244 | 0.005 |
| 12245 | 0.004 |
| 12246 | 0.002 |
| 12247 | 0.002 |
| 12248 | 0.002 |
| 12249 | 0.002 |
| 12250 | 0.006 |
| 12251 | 0.007 |
| 12252 | 0.007 |
| 12253 | 0.011 |
| 12254 | 0.007 |
| 12255 | 0.005 |
| 12256 | 0.003 |
| 12257 | 0.004 |
| 12258 | 0.001 |
| 12259 | 0.005 |
| 12260 | 0.005 |
| 12261 | 0.003 |
| 12262 | 0.003 |
| 12263 | 0.006 |
| 12264 | 0.007 |
| 12265 | 0.002 |
| 12266 | 0.007 |
| 12267 | 0.004 |
| 12268 | 0.006 |
| 12269 | 0.007 |
| 12270 | 0.001 |
| 12271 | 0.002 |
| 12272 | 0.003 |
| 12273 | 0.001 |
| 12274 | 0.004 |
| 12275 | 0.002 |
| 12276 | 0.003 |
| 12277 | 0.005 |
| 12278 | 0.002 |
| 12279 | 0.002 |
| 12280 | 0.006 |
| 12281 | 0.006 |
| 12282 | 0.009 |
| 12283 | 0.007 |
| 12284 | 0.009 |
| 12285 | 0.003 |
| 12286 | 0.002 |
| 12287 | 0.003 |
| 12288 | 0.005 |
| 12289 | 0.003 |
| 12290 | 0.002 |
| 12291 | 0.002 |
| 12292 | 0.004 |
| 12293 | 0.005 |
| 12294 | 0.002 |
| 12295 | 0.005 |
| 12296 | 0.001 |
| 12297 | 0.003 |
| 12298 | 0.005 |
| 12299 | 0.002 |
| 12300 | 0.005 |
| 12301 | 0.001 |
| 12302 | 0.007 |
| 12303 | 0.002 |
| 12304 | 0.006 |
| 12305 | 0.001 |
| 12306 | 0.006 |
| 12307 | 0.002 |
| 12308 | 0.002 |
| 12309 | 0.002 |
| 12310 | 0.004 |
| 12311 | 0.002 |
| 12312 | 0.002 |
| 12313 | 0.001 |
| 12314 | 0.005 |
| 12315 | 0.004 |
| 12316 | 0.003 |
| 12317 | 0.003 |
| 12318 | 0.004 |
| 12319 | 0.005 |
| 12320 | 0.005 |
| 12321 | 0.007 |
| 12322 | 0.007 |
| 12323 | 0.004 |
| 12324 | 0.001 |
| 12325 | 0.003 |
| 12326 | 0.002 |
| 12327 | 0.004 |
| 12328 | 0.007 |
| 12329 | 0.004 |
| 12330 | 0.01 |
| 12331 | 0.008 |
| 12332 | 0.004 |
| 12333 | 0.006 |
| 12334 | 0.006 |
| 12335 | 0.008 |
| 12336 | 0.003 |
| 12337 | 0.003 |
| 12338 | 0.004 |
| 12339 | 0.008 |
| 12340 | 0.001 |
| 12341 | 0.008 |
| 12342 | 0.004 |
| 12343 | 0.012 |
| 12344 | 0.002 |
| 12345 | 0.003 |
| 12346 | 0.006 |
| 12347 | 0.003 |
| 12348 | 0.005 |
| 12349 | 0.003 |
| 12350 | 0.003 |
| 12351 | 0.005 |
| 12352 | 0.008 |
| 12353 | 0.003 |
| 12354 | 0.005 |
| 12355 | 0.012 |
| 12356 | 0.01 |
| 12357 | 0.004 |
| 12358 | 0.004 |
| 12359 | 0.004 |
| 12360 | 0.007 |
| 12361 | 0.005 |
| 12362 | 0.003 |
| 12363 | 0.006 |
| 12364 | 0.005 |
| 12365 | 0.007 |
| 12366 | 0.002 |
| 12367 | 0.001 |
| 12368 | 0.004 |
| 12369 | 0.006 |
| 12370 | 0.004 |
| 12371 | 0.004 |
| 12372 | 0.003 |
| 12373 | 0.002 |
| 12374 | 0.004 |
| 12375 | 0.001 |
| 12376 | 0.007 |
| 12377 | 0.007 |
| 12378 | 0.003 |
| 12379 | 0.002 |
| 12380 | 0.005 |
| 12381 | 0.001 |
| 12382 | 0.003 |
| 12383 | 0.005 |
| 12384 | 0.009 |
| 12385 | 0.002 |
| 12386 | 0.004 |
| 12387 | 0.005 |
| 12388 | 0.002 |
| 12389 | 0.011 |
| 12390 | 0.003 |
| 12391 | 0.006 |
| 12392 | 0.01 |
| 12393 | 0.008 |
| 12394 | 0.001 |
| 12395 | 0.005 |
| 12396 | 0.008 |
| 12397 | 0.007 |
| 12398 | 0.005 |
| 12399 | 0.004 |
| 12400 | 0.005 |
| 12401 | 0.004 |
| 12402 | 0.002 |
| 12403 | 0.003 |
| 12404 | 0.006 |
| 12405 | 0.005 |
| 12406 | 0.001 |
| 12407 | 0.003 |
| 12408 | 0.004 |
| 12409 | 0.002 |
| 12410 | 0.002 |
| 12411 | 0.002 |
| 12412 | 0.003 |
| 12413 | 0.001 |
| 12414 | 0.003 |
| 12415 | 0.009 |
| 12416 | 0.009 |
| 12417 | 0.003 |
| 12418 | 0.003 |
| 12419 | 0.002 |
| 12420 | 0.008 |
| 12421 | 0.006 |
| 12422 | 0.002 |
| 12423 | 0.002 |
| 12424 | 0.005 |
| 12425 | 0.002 |
| 12426 | 0.004 |
| 12427 | 0.005 |
| 12428 | 0.005 |
| 12429 | 0.005 |
| 12430 | 0.001 |
| 12431 | 0.003 |
| 12432 | 0.004 |
| 12433 | 0.003 |
| 12434 | 0.002 |
| 12435 | 0.005 |
| 12436 | 0.005 |
| 12437 | 0.004 |
| 12438 | 0.003 |
| 12439 | 0.003 |
| 12440 | 0.004 |
| 12441 | 0.002 |
| 12442 | 0.003 |
| 12443 | 0.006 |
| 12444 | 0.004 |
| 12445 | 0.007 |
| 12446 | 0.003 |
| 12447 | 0.002 |
| 12448 | 0.003 |
| 12449 | 0.006 |
| 12450 | 0.001 |
| 12451 | 0.002 |
| 12452 | 0.009 |
| 12453 | 0.006 |
| 12454 | 0.003 |
| 12455 | 0.005 |
| 12456 | 0.004 |
| 12457 | 0.003 |
| 12458 | 0.004 |
| 12459 | 0.004 |
| 12460 | 0.006 |
| 12461 | 0.01 |
| 12462 | 0.004 |
| 12463 | 0.004 |
| 12464 | 0.008 |
| 12465 | 0.004 |
| 12466 | 0.002 |
| 12467 | 0.003 |
| 12468 | 0.009 |
| 12469 | 0.008 |
| 12470 | 0.004 |
| 12471 | 0.003 |
| 12472 | 0.006 |
| 12473 | 0.002 |
| 12474 | 0.003 |
| 12475 | 0.006 |
| 12476 | 0.01 |
| 12477 | 0.007 |
| 12478 | 0.006 |
| 12479 | 0.002 |
| 12480 | 0.003 |
| 12481 | 0.007 |
| 12482 | 0.002 |
| 12483 | 0.003 |
| 12484 | 0.005 |
| 12485 | 0.006 |
| 12486 | 0.003 |
| 12487 | 0.005 |
| 12488 | 0.004 |
| 12489 | 0.002 |
| 12490 | 0.001 |
| 12491 | 0.008 |
| 12492 | 0.006 |
| 12493 | 0.004 |
| 12494 | 0.002 |
| 12495 | 0.002 |
| 12496 | 0.004 |
| 12497 | 0.002 |
| 12498 | 0.001 |
| 12499 | 0.002 |
| 12500 | 0.003 |
| 12501 | 0.003 |
| 12502 | 0.002 |
| 12503 | 0.003 |
| 12504 | 0.007 |
| 12505 | 0.006 |
| 12506 | 0.003 |
| 12507 | 0.002 |
| 12508 | 0.004 |
| 12509 | 0.006 |
| 12510 | 0.002 |
| 12511 | 0.004 |
| 12512 | 0.007 |
| 12513 | 0.007 |
| 12514 | 0.003 |
| 12515 | 0.006 |
| 12516 | 0.002 |
| 12517 | 0.001 |
| 12518 | 0.002 |
| 12519 | 0.003 |
| 12520 | 0.004 |
| 12521 | 0.003 |
| 12522 | 0.003 |
| 12523 | 0.004 |
| 12524 | 0.005 |
| 12525 | 0.005 |
| 12526 | 0.002 |
| 12527 | 0.003 |
| 12528 | 0.004 |
| 12529 | 0.006 |
| 12530 | 0.003 |
| 12531 | 0.002 |
| 12532 | 0.005 |
| 12533 | 0.003 |
| 12534 | 0.002 |
| 12535 | 0.003 |
| 12536 | 0.004 |
| 12537 | 0.007 |
| 12538 | 0.003 |
| 12539 | 0.004 |
| 12540 | 0.007 |
| 12541 | 0.003 |
| 12542 | 0.003 |
| 12543 | 0.003 |
| 12544 | 0.01 |
| 12545 | 0.005 |
| 12546 | 0.003 |
| 12547 | 0.003 |
| 12548 | 0.008 |
| 12549 | 0.011 |
| 12550 | 0.001 |
| 12551 | 0.007 |
| 12552 | 0.005 |
| 12553 | 0.008 |
| 12554 | 0.005 |
| 12555 | 0.004 |
| 12556 | 0.003 |
| 12557 | 0.003 |
| 12558 | 0.003 |
| 12559 | 0.003 |
| 12560 | 0.005 |
| 12561 | 0.01 |
| 12562 | 0.004 |
| 12563 | 0.01 |
| 12564 | 0.01 |
| 12565 | 0.001 |
| 12566 | 0.004 |
| 12567 | 0.003 |
| 12568 | 0.005 |
| 12569 | 0.005 |
| 12570 | 0.004 |
| 12571 | 0.002 |
| 12572 | 0.002 |
| 12573 | 0.003 |
| 12574 | 0.003 |
| 12575 | 0.005 |
| 12576 | 0.009 |
| 12577 | 0.004 |
| 12578 | 0.002 |
| 12579 | 0.002 |
| 12580 | 0.002 |
| 12581 | 0.003 |
| 12582 | 0.002 |
| 12583 | 0.004 |
| 12584 | 0.002 |
| 12585 | 0.005 |
| 12586 | 0.002 |
| 12587 | 0.004 |
| 12588 | 0.003 |
| 12589 | 0.006 |
| 12590 | 0.003 |
| 12591 | 0.004 |
| 12592 | 0.006 |
| 12593 | 0.002 |
| 12594 | 0.003 |
| 12595 | 0.002 |
| 12596 | 0.005 |
| 12597 | 0.004 |
| 12598 | 0.003 |
| 12599 | 0.006 |
| 12600 | 0.006 |
| 12601 | 0.002 |
| 12602 | 0.006 |
| 12603 | 0.005 |
| 12604 | 0.008 |
| 12605 | 0.004 |
| 12606 | 0.003 |
| 12607 | 0.003 |
| 12608 | 0.003 |
| 12609 | 0.003 |
| 12610 | 0.003 |
| 12611 | 0.004 |
| 12612 | 0.009 |
| 12613 | 0.005 |
| 12614 | 0.004 |
| 12615 | 0.006 |
| 12616 | 0.011 |
| 12617 | 0.008 |
| 12618 | 0.007 |
| 12619 | 0.008 |
| 12620 | 0.006 |
| 12621 | 0.002 |
| 12622 | 0.001 |
| 12623 | 0.008 |
| 12624 | 0.007 |
| 12625 | 0.005 |
| 12626 | 0.003 |
| 12627 | 0.005 |
| 12628 | 0.007 |
| 12629 | 0.006 |
| 12630 | 0.008 |
| 12631 | 0.003 |
| 12632 | 0.004 |
| 12633 | 0.006 |
| 12634 | 0.007 |
| 12635 | 0.007 |
| 12636 | 0.004 |
| 12637 | 0.006 |
| 12638 | 0.006 |
| 12639 | 0.006 |
| 12640 | 0.005 |
| 12641 | 0.006 |
| 12642 | 0.004 |
| 12643 | 0.005 |
| 12644 | 0.006 |
| 12645 | 0.007 |
| 12646 | 0.002 |
| 12647 | 0.002 |
| 12648 | 0.006 |
| 12649 | 0.006 |
| 12650 | 0.008 |
| 12651 | 0.002 |
| 12652 | 0.006 |
| 12653 | 0.007 |
| 12654 | 0.01 |
| 12655 | 0.002 |
| 12656 | 0.005 |
| 12657 | 0.005 |
| 12658 | 0.004 |
| 12659 | 0.006 |
| 12660 | 0.006 |
| 12661 | 0.006 |
| 12662 | 0.007 |
| 12663 | 0.011 |
| 12664 | 0.004 |
| 12665 | 0.002 |
| 12666 | 0.006 |
| 12667 | 0.007 |
| 12668 | 0.001 |
| 12669 | 0.002 |
| 12670 | 0.001 |
| 12671 | 0.006 |
| 12672 | 0.004 |
| 12673 | 0.001 |
| 12674 | 0.004 |
| 12675 | 0.001 |
| 12676 | 0.004 |
| 12677 | 0.004 |
| 12678 | 0.005 |
| 12679 | 0.003 |
| 12680 | 0.004 |
| 12681 | 0.004 |
| 12682 | 0.004 |
| 12683 | 0.005 |
| 12684 | 0.005 |
| 12685 | 0.003 |
| 12686 | 0.002 |
| 12687 | 0.005 |
| 12688 | 0.003 |
| 12689 | 0.001 |
| 12690 | 0.005 |
| 12691 | 0.002 |
| 12692 | 0.009 |
| 12693 | 0.003 |
| 12694 | 0.003 |
| 12695 | 0.005 |
| 12696 | 0.004 |
| 12697 | 0.001 |
| 12698 | 0.004 |
| 12699 | 0.004 |
| 12700 | 0.003 |
| 12701 | 0.001 |
| 12702 | 0.002 |
| 12703 | 0.005 |
| 12704 | 0.007 |
| 12705 | 0.003 |
| 12706 | 0.001 |
| 12707 | 0.005 |
| 12708 | 0.007 |
| 12709 | 0.002 |
| 12710 | 0.004 |
| 12711 | 0.003 |
| 12712 | 0.006 |
| 12713 | 0.002 |
| 12714 | 0.004 |
| 12715 | 0.006 |
| 12716 | 0.008 |
| 12717 | 0.005 |
| 12718 | 0.003 |
| 12719 | 0.002 |
| 12720 | 0.002 |
| 12721 | 0.003 |
| 12722 | 0.002 |
| 12723 | 0.003 |
| 12724 | 0.007 |
| 12725 | 0.003 |
| 12726 | 0.002 |
| 12727 | 0.002 |
| 12728 | 0.002 |
| 12729 | 0.003 |
| 12730 | 0.003 |
| 12731 | 0.002 |
| 12732 | 0.001 |
| 12733 | 0.001 |
| 12734 | 0.002 |
| 12735 | 0.006 |
| 12736 | 0.004 |
| 12737 | 0.002 |
| 12738 | 0.005 |
| 12739 | 0.002 |
| 12740 | 0.001 |
| 12741 | 0.002 |
| 12742 | 0.004 |
| 12743 | 0.003 |
| 12744 | 0.002 |
| 12745 | 0.005 |
| 12746 | 0.001 |
| 12747 | 0.004 |
| 12748 | 0.001 |
| 12749 | 0.002 |
| 12750 | 0.003 |
| 12751 | 0.002 |
| 12752 | 0.001 |
| 12753 | 0.003 |
| 12754 | 0.003 |
| 12755 | 0.005 |
| 12756 | 0.004 |
| 12757 | 0.01 |
| 12758 | 0.001 |
| 12759 | 0.004 |
| 12760 | 0.007 |
| 12761 | 0.006 |
| 12762 | 0.003 |
| 12763 | 0.007 |
| 12764 | 0.004 |
| 12765 | 0.008 |
| 12766 | 0.001 |
| 12767 | 0.004 |
| 12768 | 0.005 |
| 12769 | 0.007 |
| 12770 | 0.006 |
| 12771 | 0.004 |
| 12772 | 0.005 |
| 12773 | 0.005 |
| 12774 | 0.003 |
| 12775 | 0.001 |
| 12776 | 0.001 |
| 12777 | 0.003 |
| 12778 | 0.002 |
| 12779 | 0.002 |
| 12780 | 0.008 |
| 12781 | 0.005 |
| 12782 | 0.005 |
| 12783 | 0.003 |
| 12784 | 0.006 |
| 12785 | 0.007 |
| 12786 | 0.004 |
| 12787 | 0.004 |
| 12788 | 0.001 |
| 12789 | 0.003 |
| 12790 | 0.001 |
| 12791 | 0.003 |
| 12792 | 0.004 |
| 12793 | 0.004 |
| 12794 | 0.003 |
| 12795 | 0.002 |
| 12796 | 0.005 |
| 12797 | 0.003 |
| 12798 | 0.004 |
| 12799 | 0.007 |
| 12800 | 0.009 |
| 12801 | 0.002 |
| 12802 | 0.002 |
| 12803 | 0.005 |
| 12804 | 0.007 |
| 12805 | 0.005 |
| 12806 | 0.005 |
| 12807 | 0.002 |
| 12808 | 0.005 |
| 12809 | 0.002 |
| 12810 | 0.005 |
| 12811 | 0.007 |
| 12812 | 0.005 |
| 12813 | 0.002 |
| 12814 | 0.005 |
| 12815 | 0.001 |
| 12816 | 0.007 |
| 12817 | 0.002 |
| 12818 | 0.005 |
| 12819 | 0.006 |
| 12820 | 0.005 |
| 12821 | 0.004 |
| 12822 | 0.004 |
| 12823 | 0.003 |
| 12824 | 0.002 |
| 12825 | 0.01 |
| 12826 | 0.011 |
| 12827 | 0.014 |
| 12828 | 0.008 |
| 12829 | 0.001 |
| 12830 | 0.004 |
| 12831 | 0.001 |
| 12832 | 0.002 |
| 12833 | 0.002 |
| 12834 | 0.002 |
| 12835 | 0.006 |
| 12836 | 0.006 |
| 12837 | 0.003 |
| 12838 | 0.004 |
| 12839 | 0.004 |
| 12840 | 0.006 |
| 12841 | 0.002 |
| 12842 | 0.004 |
| 12843 | 0.003 |
| 12844 | 0.003 |
| 12845 | 0.004 |
| 12846 | 0.013 |
| 12847 | 0.015 |
| 12848 | 0.011 |
| 12849 | 0.001 |
| 12850 | 0.003 |
| 12851 | 0.007 |
| 12852 | 0.007 |
| 12853 | 0.001 |
| 12854 | 0.005 |
| 12855 | 0.012 |
| 12856 | 0.003 |
| 12857 | 0.003 |
| 12858 | 0.001 |
| 12859 | 0.006 |
| 12860 | 0.006 |
| 12861 | 0.004 |
| 12862 | 0.005 |
| 12863 | 0.004 |
| 12864 | 0.008 |
| 12865 | 0.007 |
| 12866 | 0.003 |
| 12867 | 0.001 |
| 12868 | 0.002 |
| 12869 | 0.003 |
| 12870 | 0.002 |
| 12871 | 0.002 |
| 12872 | 0.006 |
| 12873 | 0.005 |
| 12874 | 0.002 |
| 12875 | 0.004 |
| 12876 | 0.003 |
| 12877 | 0.002 |
| 12878 | 0.004 |
| 12879 | 0.003 |
| 12880 | 0.007 |
| 12881 | 0.001 |
| 12882 | 0.005 |
| 12883 | 0.003 |
| 12884 | 0.006 |
| 12885 | 0.003 |
| 12886 | 0.007 |
| 12887 | 0.003 |
| 12888 | 0.001 |
| 12889 | 0.005 |
| 12890 | 0.001 |
| 12891 | 0.002 |
| 12892 | 0.006 |
| 12893 | 0.001 |
| 12894 | 0.002 |
| 12895 | 0.003 |
| 12896 | 0.002 |
| 12897 | 0.004 |
| 12898 | 0.002 |
| 12899 | 0.004 |
| 12900 | 0.001 |
| 12901 | 0.002 |
| 12902 | 0.002 |
| 12903 | 0.008 |
| 12904 | 0.004 |
| 12905 | 0.005 |
| 12906 | 0.009 |
| 12907 | 0.006 |
| 12908 | 0.003 |
| 12909 | 0.002 |
| 12910 | 0.002 |
| 12911 | 0.004 |
| 12912 | 0.009 |
| 12913 | 0.013 |
| 12914 | 0.004 |
| 12915 | 0.007 |
| 12916 | 0.003 |
| 12917 | 0.002 |
| 12918 | 0.005 |
| 12919 | 0.001 |
| 12920 | 0.003 |
| 12921 | 0.003 |
| 12922 | 0.003 |
| 12923 | 0.008 |
| 12924 | 0.006 |
| 12925 | 0.006 |
| 12926 | 0.003 |
| 12927 | 0.004 |
| 12928 | 0.005 |
| 12929 | 0.006 |
| 12930 | 0.002 |
| 12931 | 0.008 |
| 12932 | 0.002 |
| 12933 | 0.004 |
| 12934 | 0.001 |
| 12935 | 0.013 |
| 12936 | 0.008 |
| 12937 | 0.006 |
| 12938 | 0.004 |
| 12939 | 0.002 |
| 12940 | 0.003 |
| 12941 | 0.003 |
| 12942 | 0.003 |
| 12943 | 0.003 |
| 12944 | 0.003 |
| 12945 | 0.008 |
| 12946 | 0.004 |
| 12947 | 0.004 |
| 12948 | 0 |
| 12949 | 0.006 |
| 12950 | 0.008 |
| 12951 | 0.004 |
| 12952 | 0.005 |
| 12953 | 0.005 |
| 12954 | 0.009 |
| 12955 | 0.006 |
| 12956 | 0.002 |
| 12957 | 0.001 |
| 12958 | 0.002 |
| 12959 | 0.005 |
| 12960 | 0.004 |
| 12961 | 0.003 |
| 12962 | 0.001 |
| 12963 | 0.001 |
| 12964 | 0.009 |
| 12965 | 0.005 |
| 12966 | 0.004 |
| 12967 | 0.006 |
| 12968 | 0.009 |
| 12969 | 0.006 |
| 12970 | 0.004 |
| 12971 | 0.01 |
| 12972 | 0.004 |
| 12973 | 0.003 |
| 12974 | 0.002 |
| 12975 | 0.01 |
| 12976 | 0.005 |
| 12977 | 0.009 |
| 12978 | 0.001 |
| 12979 | 0.004 |
| 12980 | 0.004 |
| 12981 | 0.008 |
| 12982 | 0.001 |
| 12983 | 0.001 |
| 12984 | 0.009 |
| 12985 | 0.009 |
| 12986 | 0.002 |
| 12987 | 0.001 |
| 12988 | 0.01 |
| 12989 | 0.006 |
| 12990 | 0.002 |
| 12991 | 0.002 |
| 12992 | 0.004 |
| 12993 | 0.003 |
| 12994 | 0.004 |
| 12995 | 0.005 |
| 12996 | 0.004 |
| 12997 | 0 |
| 12998 | 0.002 |
| 12999 | 0.005 |
| 13000 | 0.004 |
| 13001 | 0.007 |
| 13002 | 0.003 |
| 13003 | 0.004 |
| 13004 | 0.006 |
| 13005 | 0.002 |
| 13006 | 0.005 |
| 13007 | 0.006 |
| 13008 | 0.009 |
| 13009 | 0.012 |
| 13010 | 0.006 |
| 13011 | 0.004 |
| 13012 | 0.005 |
| 13013 | 0.006 |
| 13014 | 0 |
| 13015 | 0.003 |
| 13016 | 0.004 |
| 13017 | 0.004 |
| 13018 | 0.004 |
| 13019 | 0.004 |
| 13020 | 0.006 |
| 13021 | 0.003 |
| 13022 | 0.001 |
| 13023 | 0.003 |
| 13024 | 0.005 |
| 13025 | 0.009 |
| 13026 | 0.004 |
| 13027 | 0.004 |
| 13028 | 0.005 |
| 13029 | 0.005 |
| 13030 | 0.001 |
| 13031 | 0.004 |
| 13032 | 0.008 |
| 13033 | 0.007 |
| 13034 | 0.002 |
| 13035 | 0.004 |
| 13036 | 0.011 |
| 13037 | 0.007 |
| 13038 | 0.002 |
| 13039 | 0.002 |
| 13040 | 0.009 |
| 13041 | 0.006 |
| 13042 | 0.002 |
| 13043 | 0.003 |
| 13044 | 0.005 |
| 13045 | 0.007 |
| 13046 | 0.003 |
| 13047 | 0.004 |
| 13048 | 0.005 |
| 13049 | 0.003 |
| 13050 | 0.004 |
| 13051 | 0.001 |
| 13052 | 0.005 |
| 13053 | 0.017 |
| 13054 | 0.004 |
| 13055 | 0.002 |
| 13056 | 0.003 |
| 13057 | 0.002 |
| 13058 | 0.002 |
| 13059 | 0.003 |
| 13060 | 0.006 |
| 13061 | 0.006 |
| 13062 | 0.001 |
| 13063 | 0.002 |
| 13064 | 0.002 |
| 13065 | 0.004 |
| 13066 | 0.002 |
| 13067 | 0.007 |
| 13068 | 0.002 |
| 13069 | 0.01 |
| 13070 | 0.003 |
| 13071 | 0.004 |
| 13072 | 0.006 |
| 13073 | 0.003 |
| 13074 | 0.004 |
| 13075 | 0.005 |
| 13076 | 0.001 |
| 13077 | 0.002 |
| 13078 | 0.005 |
| 13079 | 0.006 |
| 13080 | 0.005 |
| 13081 | 0.005 |
| 13082 | 0.001 |
| 13083 | 0.004 |
| 13084 | 0.003 |
| 13085 | 0.002 |
| 13086 | 0.003 |
| 13087 | 0.002 |
| 13088 | 0.006 |
| 13089 | 0.002 |
| 13090 | 0.002 |
| 13091 | 0.005 |
| 13092 | 0.011 |
| 13093 | 0.014 |
| 13094 | 0.002 |
| 13095 | 0.005 |
| 13096 | 0.005 |
| 13097 | 0.007 |
| 13098 | 0.003 |
| 13099 | 0.005 |
| 13100 | 0.002 |
| 13101 | 0.007 |
| 13102 | 0.002 |
| 13103 | 0.002 |
| 13104 | 0.006 |
| 13105 | 0.004 |
| 13106 | 0.002 |
| 13107 | 0.004 |
| 13108 | 0.001 |
| 13109 | 0.005 |
| 13110 | 0.001 |
| 13111 | 0.003 |
| 13112 | 0.002 |
| 13113 | 0.003 |
| 13114 | 0.003 |
| 13115 | 0.003 |
| 13116 | 0.003 |
| 13117 | 0.006 |
| 13118 | 0.003 |
| 13119 | 0.002 |
| 13120 | 0.003 |
| 13121 | 0.004 |
| 13122 | 0.003 |
| 13123 | 0.002 |
| 13124 | 0.005 |
| 13125 | 0.005 |
| 13126 | 0.003 |
| 13127 | 0.004 |
| 13128 | 0.008 |
| 13129 | 0.01 |
| 13130 | 0.003 |
| 13131 | 0.005 |
| 13132 | 0.006 |
| 13133 | 0.013 |
| 13134 | 0.004 |
| 13135 | 0.002 |
| 13136 | 0.005 |
| 13137 | 0.005 |
| 13138 | 0.001 |
| 13139 | 0.005 |
| 13140 | 0.002 |
| 13141 | 0.004 |
| 13142 | 0.003 |
| 13143 | 0.003 |
| 13144 | 0.004 |
| 13145 | 0.004 |
| 13146 | 0.004 |
| 13147 | 0.002 |
| 13148 | 0.007 |
| 13149 | 0.002 |
| 13150 | 0.003 |
| 13151 | 0.003 |
| 13152 | 0.003 |
| 13153 | 0.007 |
| 13154 | 0.004 |
| 13155 | 0.007 |
| 13156 | 0.002 |
| 13157 | 0.004 |
| 13158 | 0.004 |
| 13159 | 0.003 |
| 13160 | 0.003 |
| 13161 | 0.008 |
| 13162 | 0.002 |
| 13163 | 0.003 |
| 13164 | 0.005 |
| 13165 | 0.003 |
| 13166 | 0 |
| 13167 | 0.003 |
| 13168 | 0.003 |
| 13169 | 0.004 |
| 13170 | 0.003 |
| 13171 | 0.002 |
| 13172 | 0.006 |
| 13173 | 0.004 |
| 13174 | 0.003 |
| 13175 | 0.003 |
| 13176 | 0.002 |
| 13177 | 0.003 |
| 13178 | 0 |
| 13179 | 0.003 |
| 13180 | 0.002 |
| 13181 | 0.004 |
| 13182 | 0.006 |
| 13183 | 0.003 |
| 13184 | 0.002 |
| 13185 | 0.007 |
| 13186 | 0.004 |
| 13187 | 0.002 |
| 13188 | 0.003 |
| 13189 | 0.003 |
| 13190 | 0.001 |
| 13191 | 0.005 |
| 13192 | 0.003 |
| 13193 | 0.003 |
| 13194 | 0.004 |
| 13195 | 0.005 |
| 13196 | 0.003 |
| 13197 | 0.006 |
| 13198 | 0.002 |
| 13199 | 0.003 |
| 13200 | 0.005 |
| 13201 | 0.002 |
| 13202 | 0.005 |
| 13203 | 0.003 |
| 13204 | 0.004 |
| 13205 | 0.002 |
| 13206 | 0.007 |
| 13207 | 0.005 |
| 13208 | 0.001 |
| 13209 | 0.006 |
| 13210 | 0.008 |
| 13211 | 0.005 |
| 13212 | 0.004 |
| 13213 | 0.002 |
| 13214 | 0.004 |
| 13215 | 0.003 |
| 13216 | 0.004 |
| 13217 | 0 |
| 13218 | 0.008 |
| 13219 | 0.003 |
| 13220 | 0.005 |
| 13221 | 0.004 |
| 13222 | 0.006 |
| 13223 | 0.01 |
| 13224 | 0.008 |
| 13225 | 0.006 |
| 13226 | 0.008 |
| 13227 | 0.006 |
| 13228 | 0.008 |
| 13229 | 0.003 |
| 13230 | 0.003 |
| 13231 | 0.006 |
| 13232 | 0.004 |
| 13233 | 0.007 |
| 13234 | 0.003 |
| 13235 | 0.005 |
| 13236 | 0.007 |
| 13237 | 0.003 |
| 13238 | 0.004 |
| 13239 | 0.007 |
| 13240 | 0.011 |
| 13241 | 0.012 |
| 13242 | 0.003 |
| 13243 | 0.004 |
| 13244 | 0.004 |
| 13245 | 0.009 |
| 13246 | 0.007 |
| 13247 | 0.007 |
| 13248 | 0.003 |
| 13249 | 0.006 |
| 13250 | 0.004 |
| 13251 | 0.005 |
| 13252 | 0.005 |
| 13253 | 0.001 |
| 13254 | 0.002 |
| 13255 | 0.007 |
| 13256 | 0.002 |
| 13257 | 0.006 |
| 13258 | 0.002 |
| 13259 | 0.003 |
| 13260 | 0.003 |
| 13261 | 0.005 |
| 13262 | 0.003 |
| 13263 | 0.004 |
| 13264 | 0.005 |
| 13265 | 0.003 |
| 13266 | 0.003 |
| 13267 | 0.002 |
| 13268 | 0.005 |
| 13269 | 0.01 |
| 13270 | 0.005 |
| 13271 | 0.005 |
| 13272 | 0.004 |
| 13273 | 0.004 |
| 13274 | 0.003 |
| 13275 | 0.004 |
| 13276 | 0.006 |
| 13277 | 0.007 |
| 13278 | 0.002 |
| 13279 | 0.003 |
| 13280 | 0.007 |
| 13281 | 0.004 |
| 13282 | 0.004 |
| 13283 | 0.006 |
| 13284 | 0.006 |
| 13285 | 0.004 |
| 13286 | 0.004 |
| 13287 | 0.004 |
| 13288 | 0.003 |
| 13289 | 0.002 |
| 13290 | 0.005 |
| 13291 | 0.002 |
| 13292 | 0.004 |
| 13293 | 0.003 |
| 13294 | 0.001 |
| 13295 | 0.003 |
| 13296 | 0.002 |
| 13297 | 0.002 |
| 13298 | 0.003 |
| 13299 | 0.004 |
| 13300 | 0.001 |
| 13301 | 0.001 |
| 13302 | 0.003 |
| 13303 | 0.005 |
| 13304 | 0.008 |
| 13305 | 0.003 |
| 13306 | 0.004 |
| 13307 | 0.003 |
| 13308 | 0.005 |
| 13309 | 0.004 |
| 13310 | 0.005 |
| 13311 | 0.005 |
| 13312 | 0.009 |
| 13313 | 0.01 |
| 13314 | 0.002 |
| 13315 | 0.001 |
| 13316 | 0.006 |
| 13317 | 0.006 |
| 13318 | 0.002 |
| 13319 | 0.003 |
| 13320 | 0.005 |
| 13321 | 0.004 |
| 13322 | 0.001 |
| 13323 | 0.003 |
| 13324 | 0.002 |
| 13325 | 0.005 |
| 13326 | 0.003 |
| 13327 | 0.005 |
| 13328 | 0.006 |
| 13329 | 0.005 |
| 13330 | 0.003 |
| 13331 | 0.002 |
| 13332 | 0.005 |
| 13333 | 0.001 |
| 13334 | 0.002 |
| 13335 | 0.004 |
| 13336 | 0.003 |
| 13337 | 0.003 |
| 13338 | 0.002 |
| 13339 | 0.003 |
| 13340 | 0.006 |
| 13341 | 0.004 |
| 13342 | 0.004 |
| 13343 | 0.005 |
| 13344 | 0.007 |
| 13345 | 0.008 |
| 13346 | 0.003 |
| 13347 | 0.003 |
| 13348 | 0.005 |
| 13349 | 0.01 |
| 13350 | 0.005 |
| 13351 | 0.003 |
| 13352 | 0.002 |
| 13353 | 0.005 |
| 13354 | 0.003 |
| 13355 | 0.005 |
| 13356 | 0.007 |
| 13357 | 0.005 |
| 13358 | 0.002 |
| 13359 | 0.002 |
| 13360 | 0.003 |
| 13361 | 0.004 |
| 13362 | 0.002 |
| 13363 | 0.001 |
| 13364 | 0.005 |
| 13365 | 0.007 |
| 13366 | 0.001 |
| 13367 | 0.001 |
| 13368 | 0.006 |
| 13369 | 0.004 |
| 13370 | 0.003 |
| 13371 | 0.009 |
| 13372 | 0.014 |
| 13373 | 0.001 |
| 13374 | 0.001 |
| 13375 | 0.008 |
| 13376 | 0.01 |
| 13377 | 0.003 |
| 13378 | 0.003 |
| 13379 | 0.01 |
| 13380 | 0.007 |
| 13381 | 0.002 |
| 13382 | 0.006 |
| 13383 | 0.007 |
| 13384 | 0.001 |
| 13385 | 0.004 |
| 13386 | 0.003 |
| 13387 | 0.003 |
| 13388 | 0.001 |
| 13389 | 0.008 |
| 13390 | 0.006 |
| 13391 | 0.007 |
| 13392 | 0.003 |
| 13393 | 0.003 |
| 13394 | 0.002 |
| 13395 | 0.004 |
| 13396 | 0.003 |
| 13397 | 0.007 |
| 13398 | 0.006 |
| 13399 | 0.004 |
| 13400 | 0.005 |
| 13401 | 0.003 |
| 13402 | 0.002 |
| 13403 | 0.005 |
| 13404 | 0.005 |
| 13405 | 0.002 |
| 13406 | 0.005 |
| 13407 | 0.002 |
| 13408 | 0.004 |
| 13409 | 0.002 |
| 13410 | 0.007 |
| 13411 | 0.002 |
| 13412 | 0.003 |
| 13413 | 0.002 |
| 13414 | 0.001 |
| 13415 | 0.004 |
| 13416 | 0.005 |
| 13417 | 0.002 |
| 13418 | 0.002 |
| 13419 | 0.002 |
| 13420 | 0.001 |
| 13421 | 0.002 |
| 13422 | 0.004 |
| 13423 | 0.006 |
| 13424 | 0.005 |
| 13425 | 0.003 |
| 13426 | 0.005 |
| 13427 | 0.006 |
| 13428 | 0.006 |
| 13429 | 0.002 |
| 13430 | 0.001 |
| 13431 | 0.004 |
| 13432 | 0.01 |
| 13433 | 0.002 |
| 13434 | 0.004 |
| 13435 | 0.004 |
| 13436 | 0.003 |
| 13437 | 0.003 |
| 13438 | 0.005 |
| 13439 | 0.008 |
| 13440 | 0.003 |
| 13441 | 0.002 |
| 13442 | 0.002 |
| 13443 | 0.007 |
| 13444 | 0.007 |
| 13445 | 0.004 |
| 13446 | 0.002 |
| 13447 | 0.007 |
| 13448 | 0.007 |
| 13449 | 0.003 |
| 13450 | 0.004 |
| 13451 | 0.009 |
| 13452 | 0.002 |
| 13453 | 0.003 |
| 13454 | 0.002 |
| 13455 | 0.006 |
| 13456 | 0.002 |
| 13457 | 0.002 |
| 13458 | 0.003 |
| 13459 | 0.002 |
| 13460 | 0.004 |
| 13461 | 0.006 |
| 13462 | 0.002 |
| 13463 | 0.004 |
| 13464 | 0.004 |
| 13465 | 0.004 |
| 13466 | 0.001 |
| 13467 | 0.003 |
| 13468 | 0.005 |
| 13469 | 0.007 |
| 13470 | 0.002 |
| 13471 | 0.007 |
| 13472 | 0.008 |
| 13473 | 0.005 |
| 13474 | 0.004 |
| 13475 | 0.006 |
| 13476 | 0.002 |
| 13477 | 0.003 |
| 13478 | 0.002 |
| 13479 | 0.004 |
| 13480 | 0.002 |
| 13481 | 0.002 |
| 13482 | 0.002 |
| 13483 | 0.003 |
| 13484 | 0.006 |
| 13485 | 0.003 |
| 13486 | 0.001 |
| 13487 | 0.002 |
| 13488 | 0.002 |
| 13489 | 0 |
| 13490 | 0.009 |
| 13491 | 0.004 |
| 13492 | 0.004 |
| 13493 | 0.006 |
| 13494 | 0.006 |
| 13495 | 0.002 |
| 13496 | 0.003 |
| 13497 | 0.002 |
| 13498 | 0.001 |
| 13499 | 0.003 |
| 13500 | 0.007 |
| 13501 | 0.002 |
| 13502 | 0.005 |
| 13503 | 0.002 |
| 13504 | 0.003 |
| 13505 | 0.001 |
| 13506 | 0.002 |
| 13507 | 0.002 |
| 13508 | 0.001 |
| 13509 | 0.003 |
| 13510 | 0.003 |
| 13511 | 0.005 |
| 13512 | 0.003 |
| 13513 | 0.004 |
| 13514 | 0.004 |
| 13515 | 0.004 |
| 13516 | 0.004 |
| 13517 | 0.006 |
| 13518 | 0.003 |
| 13519 | 0.003 |
| 13520 | 0.008 |
| 13521 | 0.007 |
| 13522 | 0.009 |
| 13523 | 0.006 |
| 13524 | 0.004 |
| 13525 | 0.005 |
| 13526 | 0.016 |
| 13527 | 0.004 |
| 13528 | 0.007 |
| 13529 | 0.004 |
| 13530 | 0.005 |
| 13531 | 0.001 |
| 13532 | 0.007 |
| 13533 | 0.006 |
| 13534 | 0.004 |
| 13535 | 0.003 |
| 13536 | 0.005 |
| 13537 | 0.003 |
| 13538 | 0.008 |
| 13539 | 0.008 |
| 13540 | 0.005 |
| 13541 | 0.006 |
| 13542 | 0.004 |
| 13543 | 0.003 |
| 13544 | 0.005 |
| 13545 | 0.007 |
| 13546 | 0.01 |
| 13547 | 0.008 |
| 13548 | 0.005 |
| 13549 | 0.005 |
| 13550 | 0.006 |
| 13551 | 0.006 |
| 13552 | 0.007 |
| 13553 | 0.006 |
| 13554 | 0.004 |
| 13555 | 0.003 |
| 13556 | 0.003 |
| 13557 | 0.004 |
| 13558 | 0.007 |
| 13559 | 0.006 |
| 13560 | 0.003 |
| 13561 | 0.003 |
| 13562 | 0.004 |
| 13563 | 0.005 |
| 13564 | 0.003 |
| 13565 | 0.003 |
| 13566 | 0.002 |
| 13567 | 0.003 |
| 13568 | 0.009 |
| 13569 | 0.002 |
| 13570 | 0.005 |
| 13571 | 0.004 |
| 13572 | 0.006 |
| 13573 | 0.002 |
| 13574 | 0.001 |
| 13575 | 0.002 |
| 13576 | 0.011 |
| 13577 | 0.002 |
| 13578 | 0.003 |
| 13579 | 0.004 |
| 13580 | 0.006 |
| 13581 | 0.004 |
| 13582 | 0.002 |
| 13583 | 0.003 |
| 13584 | 0.003 |
| 13585 | 0.004 |
| 13586 | 0.004 |
| 13587 | 0.001 |
| 13588 | 0.004 |
| 13589 | 0.004 |
| 13590 | 0.005 |
| 13591 | 0.004 |
| 13592 | 0.001 |
| 13593 | 0.001 |
| 13594 | 0.002 |
| 13595 | 0.004 |
| 13596 | 0.003 |
| 13597 | 0.012 |
| 13598 | 0.003 |
| 13599 | 0.011 |
| 13600 | 0.009 |
| 13601 | 0.004 |
| 13602 | 0.001 |
| 13603 | 0.005 |
| 13604 | 0.002 |
| 13605 | 0.002 |
| 13606 | 0 |
| 13607 | 0.003 |
| 13608 | 0.002 |
| 13609 | 0.002 |
| 13610 | 0.002 |
| 13611 | 0.001 |
| 13612 | 0.005 |
| 13613 | 0.005 |
| 13614 | 0.002 |
| 13615 | 0.003 |
| 13616 | 0.002 |
| 13617 | 0.003 |
| 13618 | 0.002 |
| 13619 | 0.005 |
| 13620 | 0.002 |
| 13621 | 0.012 |
| 13622 | 0.005 |
| 13623 | 0.003 |
| 13624 | 0.002 |
| 13625 | 0.004 |
| 13626 | 0.003 |
| 13627 | 0.004 |
| 13628 | 0.007 |
| 13629 | 0.003 |
| 13630 | 0.001 |
| 13631 | 0.002 |
| 13632 | 0.009 |
| 13633 | 0.007 |
| 13634 | 0.002 |
| 13635 | 0.002 |
| 13636 | 0.004 |
| 13637 | 0.003 |
| 13638 | 0.005 |
| 13639 | 0.004 |
| 13640 | 0.002 |
| 13641 | 0.008 |
| 13642 | 0.004 |
| 13643 | 0.003 |
| 13644 | 0.007 |
| 13645 | 0.006 |
| 13646 | 0.004 |
| 13647 | 0.003 |
| 13648 | 0.005 |
| 13649 | 0.009 |
| 13650 | 0.004 |
| 13651 | 0.004 |
| 13652 | 0.007 |
| 13653 | 0.004 |
| 13654 | 0.002 |
| 13655 | 0.003 |
| 13656 | 0.004 |
| 13657 | 0.004 |
| 13658 | 0.003 |
| 13659 | 0.004 |
| 13660 | 0.012 |
| 13661 | 0.016 |
| 13662 | 0.001 |
| 13663 | 0.005 |
| 13664 | 0.003 |
| 13665 | 0.007 |
| 13666 | 0.002 |
| 13667 | 0.005 |
| 13668 | 0.009 |
| 13669 | 0.003 |
| 13670 | 0.002 |
| 13671 | 0.004 |
| 13672 | 0.002 |
| 13673 | 0.006 |
| 13674 | 0.005 |
| 13675 | 0.001 |
| 13676 | 0.005 |
| 13677 | 0.003 |
| 13678 | 0.003 |
| 13679 | 0.002 |
| 13680 | 0.008 |
| 13681 | 0.006 |
| 13682 | 0.002 |
| 13683 | 0.002 |
| 13684 | 0.005 |
| 13685 | 0.008 |
| 13686 | 0.006 |
| 13687 | 0.005 |
| 13688 | 0.003 |
| 13689 | 0.003 |
| 13690 | 0.002 |
| 13691 | 0.005 |
| 13692 | 0.004 |
| 13693 | 0.006 |
| 13694 | 0.003 |
| 13695 | 0.004 |
| 13696 | 0.003 |
| 13697 | 0.007 |
| 13698 | 0.004 |
| 13699 | 0.006 |
| 13700 | 0.006 |
| 13701 | 0.003 |
| 13702 | 0.011 |
| 13703 | 0.008 |
| 13704 | 0.005 |
| 13705 | 0.004 |
| 13706 | 0.003 |
| 13707 | 0.003 |
| 13708 | 0.005 |
| 13709 | 0.006 |
| 13710 | 0.003 |
| 13711 | 0.003 |
| 13712 | 0.009 |
| 13713 | 0.005 |
| 13714 | 0.002 |
| 13715 | 0.002 |
| 13716 | 0.001 |
| 13717 | 0.005 |
| 13718 | 0.001 |
| 13719 | 0.002 |
| 13720 | 0.003 |
| 13721 | 0.003 |
| 13722 | 0.003 |
| 13723 | 0.003 |
| 13724 | 0.004 |
| 13725 | 0.008 |
| 13726 | 0.005 |
| 13727 | 0.002 |
| 13728 | 0.003 |
| 13729 | 0.005 |
| 13730 | 0.002 |
| 13731 | 0.002 |
| 13732 | 0.007 |
| 13733 | 0.005 |
| 13734 | 0.003 |
| 13735 | 0.005 |
| 13736 | 0.003 |
| 13737 | 0.005 |
| 13738 | 0.003 |
| 13739 | 0.004 |
| 13740 | 0.006 |
| 13741 | 0.003 |
| 13742 | 0.003 |
| 13743 | 0.008 |
| 13744 | 0.005 |
| 13745 | 0.002 |
| 13746 | 0.002 |
| 13747 | 0.007 |
| 13748 | 0.005 |
| 13749 | 0.005 |
| 13750 | 0.002 |
| 13751 | 0.005 |
| 13752 | 0.006 |
| 13753 | 0.004 |
| 13754 | 0.002 |
| 13755 | 0.002 |
| 13756 | 0.012 |
| 13757 | 0.011 |
| 13758 | 0.002 |
| 13759 | 0.003 |
| 13760 | 0.002 |
| 13761 | 0.003 |
| 13762 | 0.002 |
| 13763 | 0.003 |
| 13764 | 0.007 |
| 13765 | 0.005 |
| 13766 | 0.003 |
| 13767 | 0.004 |
| 13768 | 0.002 |
| 13769 | 0.003 |
| 13770 | 0.003 |
| 13771 | 0.001 |
| 13772 | 0.003 |
| 13773 | 0.002 |
| 13774 | 0.003 |
| 13775 | 0.007 |
| 13776 | 0.01 |
| 13777 | 0.002 |
| 13778 | 0.003 |
| 13779 | 0.002 |
| 13780 | 0.005 |
| 13781 | 0.002 |
| 13782 | 0.002 |
| 13783 | 0.006 |
| 13784 | 0.006 |
| 13785 | 0.003 |
| 13786 | 0.002 |
| 13787 | 0.001 |
| 13788 | 0.007 |
| 13789 | 0.009 |
| 13790 | 0.004 |
| 13791 | 0.003 |
| 13792 | 0.003 |
| 13793 | 0.003 |
| 13794 | 0.002 |
| 13795 | 0.004 |
| 13796 | 0.004 |
| 13797 | 0.002 |
| 13798 | 0.005 |
| 13799 | 0.002 |
| 13800 | 0.008 |
| 13801 | 0.01 |
| 13802 | 0.011 |
| 13803 | 0.013 |
| 13804 | 0.007 |
| 13805 | 0.006 |
| 13806 | 0 |
| 13807 | 0.004 |
| 13808 | 0.005 |
| 13809 | 0.004 |
| 13810 | 0.006 |
| 13811 | 0.004 |
| 13812 | 0.004 |
| 13813 | 0.002 |
| 13814 | 0.005 |
| 13815 | 0.01 |
| 13816 | 0.002 |
| 13817 | 0.001 |
| 13818 | 0.006 |
| 13819 | 0.01 |
| 13820 | 0.004 |
| 13821 | 0.003 |
| 13822 | 0.007 |
| 13823 | 0.005 |
| 13824 | 0.005 |
| 13825 | 0.003 |
| 13826 | 0.003 |
| 13827 | 0.006 |
| 13828 | 0.002 |
| 13829 | 0.002 |
| 13830 | 0.003 |
| 13831 | 0.002 |
| 13832 | 0.001 |
| 13833 | 0.009 |
| 13834 | 0.009 |
| 13835 | 0.008 |
| 13836 | 0.004 |
| 13837 | 0.007 |
| 13838 | 0.004 |
| 13839 | 0.004 |
| 13840 | 0.005 |
| 13841 | 0.003 |
| 13842 | 0.008 |
| 13843 | 0.002 |
| 13844 | 0.006 |
| 13845 | 0.003 |
| 13846 | 0.004 |
| 13847 | 0.005 |
| 13848 | 0.007 |
| 13849 | 0.004 |
| 13850 | 0.002 |
| 13851 | 0.004 |
| 13852 | 0.005 |
| 13853 | 0.004 |
| 13854 | 0.001 |
| 13855 | 0.002 |
| 13856 | 0.004 |
| 13857 | 0.001 |
| 13858 | 0.001 |
| 13859 | 0.003 |
| 13860 | 0.002 |
| 13861 | 0.007 |
| 13862 | 0.004 |
| 13863 | 0.003 |
| 13864 | 0.004 |
| 13865 | 0.003 |
| 13866 | 0.006 |
| 13867 | 0.001 |
| 13868 | 0.003 |
| 13869 | 0.005 |
| 13870 | 0.002 |
| 13871 | 0.001 |
| 13872 | 0.005 |
| 13873 | 0.008 |
| 13874 | 0.001 |
| 13875 | 0.004 |
| 13876 | 0.006 |
| 13877 | 0.004 |
| 13878 | 0.002 |
| 13879 | 0.003 |
| 13880 | 0.005 |
| 13881 | 0.007 |
| 13882 | 0.003 |
| 13883 | 0.004 |
| 13884 | 0.002 |
| 13885 | 0.002 |
| 13886 | 0.001 |
| 13887 | 0.009 |
| 13888 | 0.005 |
| 13889 | 0.003 |
| 13890 | 0.003 |
| 13891 | 0.004 |
| 13892 | 0.002 |
| 13893 | 0.002 |
| 13894 | 0.004 |
| 13895 | 0.007 |
| 13896 | 0.003 |
| 13897 | 0.003 |
| 13898 | 0.003 |
| 13899 | 0.002 |
| 13900 | 0.009 |
| 13901 | 0.006 |
| 13902 | 0.002 |
| 13903 | 0.005 |
| 13904 | 0.007 |
| 13905 | 0.002 |
| 13906 | 0.007 |
| 13907 | 0.002 |
| 13908 | 0.005 |
| 13909 | 0.003 |
| 13910 | 0.009 |
| 13911 | 0.007 |
| 13912 | 0.005 |
| 13913 | 0.005 |
| 13914 | 0.003 |
| 13915 | 0.002 |
| 13916 | 0.008 |
| 13917 | 0.004 |
| 13918 | 0.002 |
| 13919 | 0.004 |
| 13920 | 0.004 |
| 13921 | 0.002 |
| 13922 | 0.006 |
| 13923 | 0.009 |
| 13924 | 0.005 |
| 13925 | 0.002 |
| 13926 | 0.007 |
| 13927 | 0.01 |
| 13928 | 0.007 |
| 13929 | 0.002 |
| 13930 | 0.002 |
| 13931 | 0.003 |
| 13932 | 0.006 |
| 13933 | 0.001 |
| 13934 | 0.002 |
| 13935 | 0.001 |
| 13936 | 0.003 |
| 13937 | 0.002 |
| 13938 | 0.003 |
| 13939 | 0.003 |
| 13940 | 0.008 |
| 13941 | 0.009 |
| 13942 | 0.006 |
| 13943 | 0.009 |
| 13944 | 0.002 |
| 13945 | 0.004 |
| 13946 | 0.004 |
| 13947 | 0.01 |
| 13948 | 0.007 |
| 13949 | 0.004 |
| 13950 | 0.002 |
| 13951 | 0.004 |
| 13952 | 0.005 |
| 13953 | 0.003 |
| 13954 | 0.006 |
| 13955 | 0.003 |
| 13956 | 0.004 |
| 13957 | 0.003 |
| 13958 | 0.002 |
| 13959 | 0.005 |
| 13960 | 0.007 |
| 13961 | 0.003 |
| 13962 | 0.003 |
| 13963 | 0.007 |
| 13964 | 0.008 |
| 13965 | 0.001 |
| 13966 | 0.003 |
| 13967 | 0.006 |
| 13968 | 0.002 |
| 13969 | 0.005 |
| 13970 | 0.008 |
| 13971 | 0.007 |
| 13972 | 0.005 |
| 13973 | 0.003 |
| 13974 | 0.001 |
| 13975 | 0.004 |
| 13976 | 0.006 |
| 13977 | 0.003 |
| 13978 | 0.003 |
| 13979 | 0.004 |
| 13980 | 0.003 |
| 13981 | 0.002 |
| 13982 | 0.005 |
| 13983 | 0.01 |
| 13984 | 0.003 |
| 13985 | 0.002 |
| 13986 | 0.002 |
| 13987 | 0.005 |
| 13988 | 0.002 |
| 13989 | 0 |
| 13990 | 0.005 |
| 13991 | 0.004 |
| 13992 | 0.008 |
| 13993 | 0.001 |
| 13994 | 0.003 |
| 13995 | 0.004 |
| 13996 | 0.003 |
| 13997 | 0.002 |
| 13998 | 0.004 |
| 13999 | 0.003 |
| 14000 | 0.007 |
| 14001 | 0.003 |
| 14002 | 0.005 |
| 14003 | 0.011 |
| 14004 | 0.006 |
| 14005 | 0.002 |
| 14006 | 0.008 |
| 14007 | 0.002 |
| 14008 | 0.001 |
| 14009 | 0.002 |
| 14010 | 0.001 |
| 14011 | 0.002 |
| 14012 | 0.004 |
| 14013 | 0.002 |
| 14014 | 0.003 |
| 14015 | 0.011 |
| 14016 | 0.004 |
| 14017 | 0.004 |
| 14018 | 0.002 |
| 14019 | 0.002 |
| 14020 | 0.009 |
| 14021 | 0.002 |
| 14022 | 0.003 |
| 14023 | 0.003 |
| 14024 | 0.005 |
| 14025 | 0.002 |
| 14026 | 0.001 |
| 14027 | 0.007 |
| 14028 | 0.007 |
| 14029 | 0.009 |
| 14030 | 0.003 |
| 14031 | 0.003 |
| 14032 | 0.004 |
| 14033 | 0.002 |
| 14034 | 0.002 |
| 14035 | 0.004 |
| 14036 | 0.003 |
| 14037 | 0.002 |
| 14038 | 0.004 |
| 14039 | 0.003 |
| 14040 | 0.003 |
| 14041 | 0.007 |
| 14042 | 0.006 |
| 14043 | 0.004 |
| 14044 | 0.008 |
| 14045 | 0.001 |
| 14046 | 0.003 |
| 14047 | 0.005 |
| 14048 | 0.01 |
| 14049 | 0.004 |
| 14050 | 0.003 |
| 14051 | 0.004 |
| 14052 | 0.005 |
| 14053 | 0.002 |
| 14054 | 0.002 |
| 14055 | 0.005 |
| 14056 | 0.004 |
| 14057 | 0.004 |
| 14058 | 0.006 |
| 14059 | 0.003 |
| 14060 | 0.004 |
| 14061 | 0.005 |
| 14062 | 0.004 |
| 14063 | 0.005 |
| 14064 | 0.006 |
| 14065 | 0.011 |
| 14066 | 0.002 |
| 14067 | 0.007 |
| 14068 | 0.006 |
| 14069 | 0.006 |
| 14070 | 0.004 |
| 14071 | 0.003 |
| 14072 | 0.002 |
| 14073 | 0.004 |
| 14074 | 0.003 |
| 14075 | 0.004 |
| 14076 | 0.004 |
| 14077 | 0.007 |
| 14078 | 0.002 |
| 14079 | 0.003 |
| 14080 | 0.003 |
| 14081 | 0.007 |
| 14082 | 0.001 |
| 14083 | 0.004 |
| 14084 | 0.004 |
| 14085 | 0.002 |
| 14086 | 0.003 |
| 14087 | 0.004 |
| 14088 | 0.005 |
| 14089 | 0.002 |
| 14090 | 0.002 |
| 14091 | 0.002 |
| 14092 | 0.004 |
| 14093 | 0.004 |
| 14094 | 0.004 |
| 14095 | 0.005 |
| 14096 | 0.002 |
| 14097 | 0.002 |
| 14098 | 0.002 |
| 14099 | 0.003 |
| 14100 | 0.008 |
| 14101 | 0.003 |
| 14102 | 0.002 |
| 14103 | 0.002 |
| 14104 | 0.003 |
| 14105 | 0.007 |
| 14106 | 0.007 |
| 14107 | 0.004 |
| 14108 | 0.003 |
| 14109 | 0.005 |
| 14110 | 0.005 |
| 14111 | 0.005 |
| 14112 | 0.004 |
| 14113 | 0.004 |
| 14114 | 0.002 |
| 14115 | 0.002 |
| 14116 | 0.002 |
| 14117 | 0.007 |
| 14118 | 0.007 |
| 14119 | 0.004 |
| 14120 | 0.006 |
| 14121 | 0.003 |
| 14122 | 0.006 |
| 14123 | 0.009 |
| 14124 | 0.003 |
| 14125 | 0.004 |
| 14126 | 0.006 |
| 14127 | 0.007 |
| 14128 | 0.01 |
| 14129 | 0.003 |
| 14130 | 0.005 |
| 14131 | 0.004 |
| 14132 | 0.004 |
| 14133 | 0.002 |
| 14134 | 0.004 |
| 14135 | 0.005 |
| 14136 | 0.004 |
| 14137 | 0.01 |
| 14138 | 0.01 |
| 14139 | 0.001 |
| 14140 | 0.003 |
| 14141 | 0.002 |
| 14142 | 0.005 |
| 14143 | 0.007 |
| 14144 | 0.003 |
| 14145 | 0.007 |
| 14146 | 0.004 |
| 14147 | 0.007 |
| 14148 | 0.007 |
| 14149 | 0.007 |
| 14150 | 0.002 |
| 14151 | 0.003 |
| 14152 | 0.002 |
| 14153 | 0.003 |
| 14154 | 0.002 |
| 14155 | 0.006 |
| 14156 | 0.003 |
| 14157 | 0.003 |
| 14158 | 0.004 |
| 14159 | 0.003 |
| 14160 | 0.009 |
| 14161 | 0.006 |
| 14162 | 0.009 |
| 14163 | 0.001 |
| 14164 | 0.002 |
| 14165 | 0.004 |
| 14166 | 0.003 |
| 14167 | 0.004 |
| 14168 | 0.003 |
| 14169 | 0.002 |
| 14170 | 0.004 |
| 14171 | 0.009 |
| 14172 | 0.007 |
| 14173 | 0.006 |
| 14174 | 0.004 |
| 14175 | 0.001 |
| 14176 | 0.004 |
| 14177 | 0.004 |
| 14178 | 0.003 |
| 14179 | 0.005 |
| 14180 | 0.007 |
| 14181 | 0.005 |
| 14182 | 0.002 |
| 14183 | 0.005 |
| 14184 | 0.006 |
| 14185 | 0.004 |
| 14186 | 0.003 |
| 14187 | 0.003 |
| 14188 | 0.005 |
| 14189 | 0.002 |
| 14190 | 0.003 |
| 14191 | 0.003 |
| 14192 | 0.006 |
| 14193 | 0.001 |
| 14194 | 0.001 |
| 14195 | 0.007 |
| 14196 | 0.004 |
| 14197 | 0.005 |
| 14198 | 0.008 |
| 14199 | 0.003 |
| 14200 | 0.003 |
| 14201 | 0.005 |
| 14202 | 0.002 |
| 14203 | 0.002 |
| 14204 | 0.008 |
| 14205 | 0.003 |
| 14206 | 0.003 |
| 14207 | 0.004 |
| 14208 | 0.007 |
| 14209 | 0.005 |
| 14210 | 0.002 |
| 14211 | 0.003 |
| 14212 | 0.003 |
| 14213 | 0.012 |
| 14214 | 0.004 |
| 14215 | 0.003 |
| 14216 | 0.004 |
| 14217 | 0.006 |
| 14218 | 0.004 |
| 14219 | 0.002 |
| 14220 | 0.007 |
| 14221 | 0.011 |
| 14222 | 0.003 |
| 14223 | 0.003 |
| 14224 | 0.005 |
| 14225 | 0.006 |
| 14226 | 0.004 |
| 14227 | 0.005 |
| 14228 | 0.007 |
| 14229 | 0.005 |
| 14230 | 0.002 |
| 14231 | 0.006 |
| 14232 | 0.009 |
| 14233 | 0.01 |
| 14234 | 0.002 |
| 14235 | 0.004 |
| 14236 | 0.004 |
| 14237 | 0.005 |
| 14238 | 0.003 |
| 14239 | 0.005 |
| 14240 | 0.004 |
| 14241 | 0.007 |
| 14242 | 0.002 |
| 14243 | 0.004 |
| 14244 | 0.008 |
| 14245 | 0.007 |
| 14246 | 0.001 |
| 14247 | 0.001 |
| 14248 | 0.002 |
| 14249 | 0.002 |
| 14250 | 0.003 |
| 14251 | 0.003 |
| 14252 | 0.002 |
| 14253 | 0.004 |
| 14254 | 0.003 |
| 14255 | 0.003 |
| 14256 | 0.008 |
| 14257 | 0.005 |
| 14258 | 0.001 |
| 14259 | 0.003 |
| 14260 | 0.002 |
| 14261 | 0.006 |
| 14262 | 0.002 |
| 14263 | 0.003 |
| 14264 | 0.003 |
| 14265 | 0.009 |
| 14266 | 0.004 |
| 14267 | 0.001 |
| 14268 | 0.003 |
| 14269 | 0.003 |
| 14270 | 0.002 |
| 14271 | 0.001 |
| 14272 | 0.002 |
| 14273 | 0.003 |
| 14274 | 0.001 |
| 14275 | 0.003 |
| 14276 | 0.005 |
| 14277 | 0.012 |
| 14278 | 0.002 |
| 14279 | 0.003 |
| 14280 | 0.003 |
| 14281 | 0.003 |
| 14282 | 0.001 |
| 14283 | 0.004 |
| 14284 | 0.005 |
| 14285 | 0.004 |
| 14286 | 0.001 |
| 14287 | 0.002 |
| 14288 | 0.006 |
| 14289 | 0.007 |
| 14290 | 0.002 |
| 14291 | 0.005 |
| 14292 | 0.003 |
| 14293 | 0.003 |
| 14294 | 0.003 |
| 14295 | 0.003 |
| 14296 | 0.005 |
| 14297 | 0.002 |
| 14298 | 0.004 |
| 14299 | 0.003 |
| 14300 | 0.005 |
| 14301 | 0.004 |
| 14302 | 0.002 |
| 14303 | 0.002 |
| 14304 | 0.006 |
| 14305 | 0.005 |
| 14306 | 0 |
| 14307 | 0.001 |
| 14308 | 0.003 |
| 14309 | 0.006 |
| 14310 | 0.005 |
| 14311 | 0.001 |
| 14312 | 0.002 |
| 14313 | 0.003 |
| 14314 | 0.003 |
| 14315 | 0.006 |
| 14316 | 0.007 |
| 14317 | 0.005 |
| 14318 | 0.002 |
| 14319 | 0.002 |
| 14320 | 0.001 |
| 14321 | 0.003 |
| 14322 | 0.002 |
| 14323 | 0.002 |
| 14324 | 0.004 |
| 14325 | 0.002 |
| 14326 | 0.001 |
| 14327 | 0.004 |
| 14328 | 0.008 |
| 14329 | 0.011 |
| 14330 | 0.002 |
| 14331 | 0.002 |
| 14332 | 0.001 |
| 14333 | 0.002 |
| 14334 | 0.003 |
| 14335 | 0.005 |
| 14336 | 0.003 |
| 14337 | 0.004 |
| 14338 | 0.005 |
| 14339 | 0.002 |
| 14340 | 0.006 |
| 14341 | 0.006 |
| 14342 | 0.005 |
| 14343 | 0.004 |
| 14344 | 0.006 |
| 14345 | 0.002 |
| 14346 | 0.005 |
| 14347 | 0.004 |
| 14348 | 0.004 |
| 14349 | 0.01 |
| 14350 | 0.003 |
| 14351 | 0.002 |
| 14352 | 0.003 |
| 14353 | 0.002 |
| 14354 | 0.002 |
| 14355 | 0.005 |
| 14356 | 0.005 |
| 14357 | 0.009 |
| 14358 | 0.003 |
| 14359 | 0.004 |
| 14360 | 0.005 |
| 14361 | 0.003 |
| 14362 | 0.005 |
| 14363 | 0.006 |
| 14364 | 0.008 |
| 14365 | 0.006 |
| 14366 | 0.001 |
| 14367 | 0.004 |
| 14368 | 0.004 |
| 14369 | 0.005 |
| 14370 | 0.004 |
| 14371 | 0.005 |
| 14372 | 0.005 |
| 14373 | 0.006 |
| 14374 | 0.006 |
| 14375 | 0.003 |
| 14376 | 0.004 |
| 14377 | 0.006 |
| 14378 | 0.003 |
| 14379 | 0.001 |
| 14380 | 0.007 |
| 14381 | 0.004 |
| 14382 | 0.003 |
| 14383 | 0.007 |
| 14384 | 0.008 |
| 14385 | 0.007 |
| 14386 | 0.003 |
| 14387 | 0.004 |
| 14388 | 0.007 |
| 14389 | 0.006 |
| 14390 | 0.003 |
| 14391 | 0.008 |
| 14392 | 0.009 |
| 14393 | 0.005 |
| 14394 | 0.003 |
| 14395 | 0.006 |
| 14396 | 0.001 |
| 14397 | 0.002 |
| 14398 | 0.003 |
| 14399 | 0.003 |
| 14400 | 0.003 |
| 14401 | 0.004 |
| 14402 | 0.002 |
| 14403 | 0.002 |
| 14404 | 0.001 |
| 14405 | 0.005 |
| 14406 | 0.002 |
| 14407 | 0.005 |
| 14408 | 0.003 |
| 14409 | 0.003 |
| 14410 | 0.003 |
| 14411 | 0.004 |
| 14412 | 0.002 |
| 14413 | 0.003 |
| 14414 | 0.006 |
| 14415 | 0.003 |
| 14416 | 0.004 |
| 14417 | 0.006 |
| 14418 | 0.007 |
| 14419 | 0.002 |
| 14420 | 0.004 |
| 14421 | 0.002 |
| 14422 | 0.004 |
| 14423 | 0.005 |
| 14424 | 0.006 |
| 14425 | 0.003 |
| 14426 | 0.008 |
| 14427 | 0.002 |
| 14428 | 0.004 |
| 14429 | 0.002 |
| 14430 | 0.005 |
| 14431 | 0.003 |
| 14432 | 0.005 |
| 14433 | 0.005 |
| 14434 | 0.002 |
| 14435 | 0.011 |
| 14436 | 0.002 |
| 14437 | 0.003 |
| 14438 | 0.004 |
| 14439 | 0.003 |
| 14440 | 0.012 |
| 14441 | 0.002 |
| 14442 | 0.002 |
| 14443 | 0.006 |
| 14444 | 0.01 |
| 14445 | 0.002 |
| 14446 | 0.003 |
| 14447 | 0.004 |
| 14448 | 0.007 |
| 14449 | 0.007 |
| 14450 | 0.004 |
| 14451 | 0.007 |
| 14452 | 0.007 |
| 14453 | 0.002 |
| 14454 | 0.004 |
| 14455 | 0.008 |
| 14456 | 0.011 |
| 14457 | 0.006 |
| 14458 | 0.006 |
| 14459 | 0.003 |
| 14460 | 0.002 |
| 14461 | 0.003 |
| 14462 | 0.002 |
| 14463 | 0.003 |
| 14464 | 0.005 |
| 14465 | 0.004 |
| 14466 | 0.003 |
| 14467 | 0.003 |
| 14468 | 0.004 |
| 14469 | 0.006 |
| 14470 | 0.005 |
| 14471 | 0.004 |
| 14472 | 0.004 |
| 14473 | 0.003 |
| 14474 | 0.003 |
| 14475 | 0.003 |
| 14476 | 0.005 |
| 14477 | 0.006 |
| 14478 | 0.004 |
| 14479 | 0.003 |
| 14480 | 0.004 |
| 14481 | 0.005 |
| 14482 | 0.002 |
| 14483 | 0.003 |
| 14484 | 0.003 |
| 14485 | 0.006 |
| 14486 | 0.005 |
| 14487 | 0.002 |
| 14488 | 0.002 |
| 14489 | 0.002 |
| 14490 | 0.005 |
| 14491 | 0.001 |
| 14492 | 0.006 |
| 14493 | 0.009 |
| 14494 | 0.003 |
| 14495 | 0.005 |
| 14496 | 0.004 |
| 14497 | 0.005 |
| 14498 | 0.003 |
| 14499 | 0.004 |
| 14500 | 0.009 |
| 14501 | 0.005 |
| 14502 | 0.001 |
| 14503 | 0.002 |
| 14504 | 0.003 |
| 14505 | 0.005 |
| 14506 | 0.002 |
| 14507 | 0.005 |
| 14508 | 0.007 |
| 14509 | 0.009 |
| 14510 | 0.003 |
| 14511 | 0.005 |
| 14512 | 0.006 |
| 14513 | 0.004 |
| 14514 | 0.005 |
| 14515 | 0.006 |
| 14516 | 0.008 |
| 14517 | 0.002 |
| 14518 | 0.002 |
| 14519 | 0.005 |
| 14520 | 0.008 |
| 14521 | 0.003 |
| 14522 | 0.002 |
| 14523 | 0.007 |
| 14524 | 0.001 |
| 14525 | 0 |
| 14526 | 0.003 |
| 14527 | 0.011 |
| 14528 | 0.006 |
| 14529 | 0.002 |
| 14530 | 0.003 |
| 14531 | 0.001 |
| 14532 | 0.006 |
| 14533 | 0.003 |
| 14534 | 0.002 |
| 14535 | 0.001 |
| 14536 | 0.003 |
| 14537 | 0.002 |
| 14538 | 0.003 |
| 14539 | 0.005 |
| 14540 | 0.002 |
| 14541 | 0.004 |
| 14542 | 0.011 |
| 14543 | 0.008 |
| 14544 | 0.007 |
| 14545 | 0.003 |
| 14546 | 0.004 |
| 14547 | 0.004 |
| 14548 | 0.004 |
| 14549 | 0.004 |
| 14550 | 0.004 |
| 14551 | 0.009 |
| 14552 | 0.003 |
| 14553 | 0.003 |
| 14554 | 0.002 |
| 14555 | 0.003 |
| 14556 | 0.003 |
| 14557 | 0.003 |
| 14558 | 0.002 |
| 14559 | 0.004 |
| 14560 | 0.006 |
| 14561 | 0.002 |
| 14562 | 0.002 |
| 14563 | 0.008 |
| 14564 | 0.006 |
| 14565 | 0.002 |
| 14566 | 0.004 |
| 14567 | 0.003 |
| 14568 | 0.01 |
| 14569 | 0.001 |
| 14570 | 0.004 |
| 14571 | 0.004 |
| 14572 | 0.002 |
| 14573 | 0.002 |
| 14574 | 0.003 |
| 14575 | 0.002 |
| 14576 | 0.003 |
| 14577 | 0.001 |
| 14578 | 0.002 |
| 14579 | 0.006 |
| 14580 | 0.004 |
| 14581 | 0.002 |
| 14582 | 0.001 |
| 14583 | 0.004 |
| 14584 | 0.004 |
| 14585 | 0.003 |
| 14586 | 0.003 |
| 14587 | 0.003 |
| 14588 | 0.003 |
| 14589 | 0.005 |
| 14590 | 0.002 |
| 14591 | 0.006 |
| 14592 | 0.005 |
| 14593 | 0.003 |
| 14594 | 0.004 |
| 14595 | 0.005 |
| 14596 | 0.006 |
| 14597 | 0.001 |
| 14598 | 0.002 |
| 14599 | 0.006 |
| 14600 | 0.005 |
| 14601 | 0.005 |
| 14602 | 0.003 |
| 14603 | 0.002 |
| 14604 | 0.004 |
| 14605 | 0.007 |
| 14606 | 0.003 |
| 14607 | 0.004 |
| 14608 | 0.005 |
| 14609 | 0.004 |
| 14610 | 0.003 |
| 14611 | 0.004 |
| 14612 | 0.003 |
| 14613 | 0.003 |
| 14614 | 0.002 |
| 14615 | 0.007 |
| 14616 | 0.01 |
| 14617 | 0.004 |
| 14618 | 0.002 |
| 14619 | 0.002 |
| 14620 | 0.007 |
| 14621 | 0.006 |
| 14622 | 0.003 |
| 14623 | 0.004 |
| 14624 | 0.004 |
| 14625 | 0.002 |
| 14626 | 0.002 |
| 14627 | 0.003 |
| 14628 | 0.003 |
| 14629 | 0.01 |
| 14630 | 0.002 |
| 14631 | 0.004 |
| 14632 | 0.005 |
| 14633 | 0.004 |
| 14634 | 0.006 |
| 14635 | 0.005 |
| 14636 | 0.008 |
| 14637 | 0.01 |
| 14638 | 0.002 |
| 14639 | 0.007 |
| 14640 | 0.004 |
| 14641 | 0.007 |
| 14642 | 0.003 |
| 14643 | 0.006 |
| 14644 | 0.005 |
| 14645 | 0.002 |
| 14646 | 0.002 |
| 14647 | 0.003 |
| 14648 | 0.004 |
| 14649 | 0.004 |
| 14650 | 0.002 |
| 14651 | 0.001 |
| 14652 | 0.011 |
| 14653 | 0.005 |
| 14654 | 0.002 |
| 14655 | 0.002 |
| 14656 | 0.002 |
| 14657 | 0.004 |
| 14658 | 0.004 |
| 14659 | 0.003 |
| 14660 | 0.002 |
| 14661 | 0.001 |
| 14662 | 0.003 |
| 14663 | 0.005 |
| 14664 | 0.01 |
| 14665 | 0.002 |
| 14666 | 0.001 |
| 14667 | 0.002 |
| 14668 | 0.007 |
| 14669 | 0.005 |
| 14670 | 0.004 |
| 14671 | 0.003 |
| 14672 | 0.006 |
| 14673 | 0.004 |
| 14674 | 0.007 |
| 14675 | 0.007 |
| 14676 | 0.003 |
| 14677 | 0.003 |
| 14678 | 0.005 |
| 14679 | 0.007 |
| 14680 | 0.003 |
| 14681 | 0.006 |
| 14682 | 0.003 |
| 14683 | 0.004 |
| 14684 | 0.003 |
| 14685 | 0.006 |
| 14686 | 0.006 |
| 14687 | 0.002 |
| 14688 | 0.003 |
| 14689 | 0.005 |
| 14690 | 0.004 |
| 14691 | 0.006 |
| 14692 | 0.003 |
| 14693 | 0.004 |
| 14694 | 0.002 |
| 14695 | 0.001 |
| 14696 | 0.005 |
| 14697 | 0.005 |
| 14698 | 0.004 |
| 14699 | 0.003 |
| 14700 | 0.003 |
| 14701 | 0.002 |
| 14702 | 0.002 |
| 14703 | 0.005 |
| 14704 | 0.003 |
| 14705 | 0.004 |
| 14706 | 0.001 |
| 14707 | 0.002 |
| 14708 | 0.002 |
| 14709 | 0.004 |
| 14710 | 0.004 |
| 14711 | 0.005 |
| 14712 | 0.004 |
| 14713 | 0.004 |
| 14714 | 0.005 |
| 14715 | 0.008 |
| 14716 | 0.004 |
| 14717 | 0.003 |
| 14718 | 0.005 |
| 14719 | 0.004 |
| 14720 | 0.003 |
| 14721 | 0.004 |
| 14722 | 0.002 |
| 14723 | 0.003 |
| 14724 | 0.005 |
| 14725 | 0.001 |
| 14726 | 0.005 |
| 14727 | 0.001 |
| 14728 | 0.001 |
| 14729 | 0.006 |
| 14730 | 0.001 |
| 14731 | 0.005 |
| 14732 | 0.002 |
| 14733 | 0.004 |
| 14734 | 0.004 |
| 14735 | 0.001 |
| 14736 | 0.003 |
| 14737 | 0.004 |
| 14738 | 0.004 |
| 14739 | 0.002 |
| 14740 | 0.002 |
| 14741 | 0.003 |
| 14742 | 0.001 |
| 14743 | 0.004 |
| 14744 | 0.007 |
| 14745 | 0.004 |
| 14746 | 0.003 |
| 14747 | 0.004 |
| 14748 | 0.004 |
| 14749 | 0.002 |
| 14750 | 0.003 |
| 14751 | 0.006 |
| 14752 | 0.009 |
| 14753 | 0.003 |
| 14754 | 0.006 |
| 14755 | 0.004 |
| 14756 | 0.006 |
| 14757 | 0.007 |
| 14758 | 0.003 |
| 14759 | 0.003 |
| 14760 | 0.004 |
| 14761 | 0.005 |
| 14762 | 0.001 |
| 14763 | 0.003 |
| 14764 | 0.006 |
| 14765 | 0.005 |
| 14766 | 0.01 |
| 14767 | 0.003 |
| 14768 | 0.003 |
| 14769 | 0.002 |
| 14770 | 0.003 |
| 14771 | 0.007 |
| 14772 | 0.007 |
| 14773 | 0.003 |
| 14774 | 0.003 |
| 14775 | 0.005 |
| 14776 | 0.006 |
| 14777 | 0.005 |
| 14778 | 0.007 |
| 14779 | 0.004 |
| 14780 | 0.007 |
| 14781 | 0.006 |
| 14782 | 0.007 |
| 14783 | 0.004 |
| 14784 | 0.01 |
| 14785 | 0.006 |
| 14786 | 0.005 |
| 14787 | 0.003 |
| 14788 | 0.002 |
| 14789 | 0.008 |
| 14790 | 0.006 |
| 14791 | 0.006 |
| 14792 | 0.002 |
| 14793 | 0.006 |
| 14794 | 0.002 |
| 14795 | 0.002 |
| 14796 | 0.01 |
| 14797 | 0.005 |
| 14798 | 0.002 |
| 14799 | 0.002 |
| 14800 | 0.005 |
| 14801 | 0.003 |
| 14802 | 0.001 |
| 14803 | 0.002 |
| 14804 | 0.006 |
| 14805 | 0.006 |
| 14806 | 0.004 |
| 14807 | 0.004 |
| 14808 | 0.001 |
| 14809 | 0.002 |
| 14810 | 0.003 |
| 14811 | 0.01 |
| 14812 | 0.007 |
| 14813 | 0.002 |
| 14814 | 0.001 |
| 14815 | 0.004 |
| 14816 | 0.002 |
| 14817 | 0.003 |
| 14818 | 0.005 |
| 14819 | 0.005 |
| 14820 | 0.011 |
| 14821 | 0.006 |
| 14822 | 0.007 |
| 14823 | 0.006 |
| 14824 | 0.002 |
| 14825 | 0.001 |
| 14826 | 0.006 |
| 14827 | 0.009 |
| 14828 | 0.007 |
| 14829 | 0.003 |
| 14830 | 0.001 |
| 14831 | 0.006 |
| 14832 | 0.007 |
| 14833 | 0.002 |
| 14834 | 0.003 |
| 14835 | 0.01 |
| 14836 | 0.01 |
| 14837 | 0.003 |
| 14838 | 0.003 |
| 14839 | 0.01 |
| 14840 | 0.006 |
| 14841 | 0.001 |
| 14842 | 0.003 |
| 14843 | 0.005 |
| 14844 | 0.002 |
| 14845 | 0.004 |
| 14846 | 0.004 |
| 14847 | 0.003 |
| 14848 | 0.002 |
| 14849 | 0.003 |
| 14850 | 0.008 |
| 14851 | 0.007 |
| 14852 | 0.004 |
| 14853 | 0.001 |
| 14854 | 0.002 |
| 14855 | 0.006 |
| 14856 | 0.005 |
| 14857 | 0.004 |
| 14858 | 0.006 |
| 14859 | 0.007 |
| 14860 | 0.005 |
| 14861 | 0.002 |
| 14862 | 0.002 |
| 14863 | 0.006 |
| 14864 | 0.013 |
| 14865 | 0.002 |
| 14866 | 0.001 |
| 14867 | 0.001 |
| 14868 | 0.003 |
| 14869 | 0.004 |
| 14870 | 0.012 |
| 14871 | 0.009 |
| 14872 | 0.002 |
| 14873 | 0.003 |
| 14874 | 0.008 |
| 14875 | 0.004 |
| 14876 | 0.002 |
| 14877 | 0.002 |
| 14878 | 0.002 |
| 14879 | 0.003 |
| 14880 | 0.002 |
| 14881 | 0.001 |
| 14882 | 0.002 |
| 14883 | 0.005 |
| 14884 | 0.006 |
| 14885 | 0.003 |
| 14886 | 0.002 |
| 14887 | 0.005 |
| 14888 | 0.014 |
| 14889 | 0.004 |
| 14890 | 0.005 |
| 14891 | 0.007 |
| 14892 | 0.003 |
| 14893 | 0.003 |
| 14894 | 0.004 |
| 14895 | 0.003 |
| 14896 | 0.002 |
| 14897 | 0.003 |
| 14898 | 0.008 |
| 14899 | 0.002 |
| 14900 | 0.004 |
| 14901 | 0.003 |
| 14902 | 0.002 |
| 14903 | 0.006 |
| 14904 | 0.003 |
| 14905 | 0.002 |
| 14906 | 0.003 |
| 14907 | 0.006 |
| 14908 | 0.002 |
| 14909 | 0.004 |
| 14910 | 0.001 |
| 14911 | 0.006 |
| 14912 | 0.003 |
| 14913 | 0.003 |
| 14914 | 0.003 |
| 14915 | 0.002 |
| 14916 | 0.001 |
| 14917 | 0.004 |
| 14918 | 0.005 |
| 14919 | 0.008 |
| 14920 | 0.007 |
| 14921 | 0.005 |
| 14922 | 0.007 |
| 14923 | 0.01 |
| 14924 | 0.005 |
| 14925 | 0.005 |
| 14926 | 0.002 |
| 14927 | 0.005 |
| 14928 | 0.004 |
| 14929 | 0.001 |
| 14930 | 0.003 |
| 14931 | 0.007 |
| 14932 | 0.013 |
| 14933 | 0.007 |
| 14934 | 0.001 |
| 14935 | 0.006 |
| 14936 | 0.006 |
| 14937 | 0.002 |
| 14938 | 0.003 |
| 14939 | 0.01 |
| 14940 | 0.003 |
| 14941 | 0.003 |
| 14942 | 0.006 |
| 14943 | 0.005 |
| 14944 | 0.008 |
| 14945 | 0.003 |
| 14946 | 0.005 |
| 14947 | 0.007 |
| 14948 | 0.004 |
| 14949 | 0.003 |
| 14950 | 0.005 |
| 14951 | 0.006 |
| 14952 | 0.003 |
| 14953 | 0.001 |
| 14954 | 0.002 |
| 14955 | 0.004 |
| 14956 | 0.006 |
| 14957 | 0.002 |
| 14958 | 0.002 |
| 14959 | 0.002 |
| 14960 | 0.004 |
| 14961 | 0.003 |
| 14962 | 0.003 |
| 14963 | 0.009 |
| 14964 | 0.007 |
| 14965 | 0.002 |
| 14966 | 0.004 |
| 14967 | 0.005 |
| 14968 | 0.001 |
| 14969 | 0.005 |
| 14970 | 0.006 |
| 14971 | 0.007 |
| 14972 | 0.004 |
| 14973 | 0.009 |
| 14974 | 0.004 |
| 14975 | 0.008 |
| 14976 | 0.008 |
| 14977 | 0.005 |
| 14978 | 0.001 |
| 14979 | 0.002 |
| 14980 | 0.003 |
| 14981 | 0.007 |
| 14982 | 0.001 |
| 14983 | 0.002 |
| 14984 | 0.005 |
| 14985 | 0.005 |
| 14986 | 0.004 |
| 14987 | 0.003 |
| 14988 | 0.006 |
| 14989 | 0.006 |
| 14990 | 0.004 |
| 14991 | 0.003 |
| 14992 | 0.004 |
| 14993 | 0.006 |
| 14994 | 0.002 |
| 14995 | 0.001 |
| 14996 | 0.012 |
| 14997 | 0.002 |
| 14998 | 0.004 |
| 14999 | 0.005 |
| 15000 | 0.003 |
| 15001 | 0.003 |
| 15002 | 0.002 |
| 15003 | 0.001 |
| 15004 | 0.005 |
| 15005 | 0.004 |
| 15006 | 0.001 |
| 15007 | 0.004 |
| 15008 | 0.006 |
| 15009 | 0.001 |
| 15010 | 0.002 |
| 15011 | 0.006 |
| 15012 | 0.002 |
| 15013 | 0.004 |
| 15014 | 0.003 |
| 15015 | 0.003 |
| 15016 | 0.003 |
| 15017 | 0.002 |
| 15018 | 0.002 |
| 15019 | 0.005 |
| 15020 | 0.008 |
| 15021 | 0.008 |
| 15022 | 0.004 |
| 15023 | 0.011 |
| 15024 | 0.01 |
| 15025 | 0.003 |
| 15026 | 0.006 |
| 15027 | 0.004 |
| 15028 | 0.007 |
| 15029 | 0.009 |
| 15030 | 0.004 |
| 15031 | 0.002 |
| 15032 | 0.007 |
| 15033 | 0.003 |
| 15034 | 0.005 |
| 15035 | 0.002 |
| 15036 | 0.003 |
| 15037 | 0.002 |
| 15038 | 0.003 |
| 15039 | 0.01 |
| 15040 | 0.003 |
| 15041 | 0.002 |
| 15042 | 0.001 |
| 15043 | 0.005 |
| 15044 | 0.003 |
| 15045 | 0.002 |
| 15046 | 0.006 |
| 15047 | 0.002 |
| 15048 | 0.002 |
| 15049 | 0.005 |
| 15050 | 0.003 |
| 15051 | 0.003 |
| 15052 | 0.009 |
| 15053 | 0.004 |
| 15054 | 0.004 |
| 15055 | 0.006 |
| 15056 | 0.002 |
| 15057 | 0.004 |
| 15058 | 0.005 |
| 15059 | 0.002 |
| 15060 | 0.002 |
| 15061 | 0.003 |
| 15062 | 0.007 |
| 15063 | 0.003 |
| 15064 | 0.005 |
| 15065 | 0.006 |
| 15066 | 0.011 |
| 15067 | 0.003 |
| 15068 | 0.005 |
| 15069 | 0.005 |
| 15070 | 0.005 |
| 15071 | 0.009 |
| 15072 | 0.003 |
| 15073 | 0.006 |
| 15074 | 0.01 |
| 15075 | 0.006 |
| 15076 | 0.004 |
| 15077 | 0.005 |
| 15078 | 0.002 |
| 15079 | 0.003 |
| 15080 | 0.001 |
| 15081 | 0.005 |
| 15082 | 0.002 |
| 15083 | 0.009 |
| 15084 | 0.004 |
| 15085 | 0.007 |
| 15086 | 0.009 |
| 15087 | 0.002 |
| 15088 | 0.009 |
| 15089 | 0.007 |
| 15090 | 0.003 |
| 15091 | 0.007 |
| 15092 | 0.005 |
| 15093 | 0.005 |
| 15094 | 0.007 |
| 15095 | 0.011 |
| 15096 | 0.006 |
| 15097 | 0.008 |
| 15098 | 0.01 |
| 15099 | 0.012 |
| 15100 | 0.001 |
| 15101 | 0.003 |
| 15102 | 0.003 |
| 15103 | 0.003 |
| 15104 | 0.002 |
| 15105 | 0.003 |
| 15106 | 0.003 |
| 15107 | 0.003 |
| 15108 | 0.002 |
| 15109 | 0.002 |
| 15110 | 0.003 |
| 15111 | 0.006 |
| 15112 | 0.003 |
| 15113 | 0.007 |
| 15114 | 0.016 |
| 15115 | 0.005 |
| 15116 | 0.008 |
| 15117 | 0.002 |
| 15118 | 0.002 |
| 15119 | 0.005 |
| 15120 | 0.007 |
| 15121 | 0.004 |
| 15122 | 0.004 |
| 15123 | 0.005 |
| 15124 | 0.008 |
| 15125 | 0.005 |
| 15126 | 0.003 |
| 15127 | 0.006 |
| 15128 | 0.01 |
| 15129 | 0.005 |
| 15130 | 0.001 |
| 15131 | 0.001 |
| 15132 | 0.005 |
| 15133 | 0.005 |
| 15134 | 0.002 |
| 15135 | 0.005 |
| 15136 | 0.003 |
| 15137 | 0.004 |
| 15138 | 0.004 |
| 15139 | 0.002 |
| 15140 | 0.005 |
| 15141 | 0.001 |
| 15142 | 0.005 |
| 15143 | 0.003 |
| 15144 | 0.003 |
| 15145 | 0.001 |
| 15146 | 0.001 |
| 15147 | 0.001 |
| 15148 | 0.004 |
| 15149 | 0.001 |
| 15150 | 0.003 |
| 15151 | 0.007 |
| 15152 | 0.007 |
| 15153 | 0.003 |
| 15154 | 0.002 |
| 15155 | 0.006 |
| 15156 | 0.004 |
| 15157 | 0.005 |
| 15158 | 0.005 |
| 15159 | 0.009 |
| 15160 | 0.01 |
| 15161 | 0.003 |
| 15162 | 0.004 |
| 15163 | 0.006 |
| 15164 | 0.005 |
| 15165 | 0.003 |
| 15166 | 0.007 |
| 15167 | 0.008 |
| 15168 | 0.011 |
| 15169 | 0.003 |
| 15170 | 0.004 |
| 15171 | 0.008 |
| 15172 | 0.006 |
| 15173 | 0.006 |
| 15174 | 0.002 |
| 15175 | 0.005 |
| 15176 | 0.01 |
| 15177 | 0.005 |
| 15178 | 0.003 |
| 15179 | 0.001 |
| 15180 | 0.007 |
| 15181 | 0.001 |
| 15182 | 0.002 |
| 15183 | 0.002 |
| 15184 | 0.004 |
| 15185 | 0.006 |
| 15186 | 0.003 |
| 15187 | 0.001 |
| 15188 | 0.004 |
| 15189 | 0.003 |
| 15190 | 0.001 |
| 15191 | 0.001 |
| 15192 | 0.005 |
| 15193 | 0.003 |
| 15194 | 0.004 |
| 15195 | 0.002 |
| 15196 | 0.001 |
| 15197 | 0.001 |
| 15198 | 0.002 |
| 15199 | 0.001 |
| 15200 | 0.007 |
| 15201 | 0.006 |
| 15202 | 0.006 |
| 15203 | 0.005 |
| 15204 | 0.011 |
| 15205 | 0.008 |
| 15206 | 0.004 |
| 15207 | 0.004 |
| 15208 | 0.007 |
| 15209 | 0.006 |
| 15210 | 0.006 |
| 15211 | 0.007 |
| 15212 | 0.004 |
| 15213 | 0.003 |
| 15214 | 0.003 |
| 15215 | 0.003 |
| 15216 | 0.01 |
| 15217 | 0.006 |
| 15218 | 0.004 |
| 15219 | 0.004 |
| 15220 | 0.008 |
| 15221 | 0.007 |
| 15222 | 0.004 |
| 15223 | 0.004 |
| 15224 | 0.008 |
| 15225 | 0.007 |
| 15226 | 0.001 |
| 15227 | 0.004 |
| 15228 | 0.01 |
| 15229 | 0.002 |
| 15230 | 0.002 |
| 15231 | 0.005 |
| 15232 | 0.005 |
| 15233 | 0.003 |
| 15234 | 0.002 |
| 15235 | 0.005 |
| 15236 | 0.005 |
| 15237 | 0.003 |
| 15238 | 0.004 |
| 15239 | 0.005 |
| 15240 | 0.008 |
| 15241 | 0.003 |
| 15242 | 0.001 |
| 15243 | 0.008 |
| 15244 | 0.005 |
| 15245 | 0.001 |
| 15246 | 0.003 |
| 15247 | 0.003 |
| 15248 | 0.01 |
| 15249 | 0.004 |
| 15250 | 0.003 |
| 15251 | 0.004 |
| 15252 | 0.007 |
| 15253 | 0.002 |
| 15254 | 0.003 |
| 15255 | 0.005 |
| 15256 | 0.002 |
| 15257 | 0.005 |
| 15258 | 0.009 |
| 15259 | 0.011 |
| 15260 | 0.006 |
| 15261 | 0.004 |
| 15262 | 0.005 |
| 15263 | 0.006 |
| 15264 | 0.008 |
| 15265 | 0.002 |
| 15266 | 0.006 |
| 15267 | 0.004 |
| 15268 | 0.003 |
| 15269 | 0.002 |
| 15270 | 0.003 |
| 15271 | 0.002 |
| 15272 | 0.006 |
| 15273 | 0.008 |
| 15274 | 0.002 |
| 15275 | 0.002 |
| 15276 | 0.01 |
| 15277 | 0.004 |
| 15278 | 0.001 |
| 15279 | 0.003 |
| 15280 | 0.004 |
| 15281 | 0.001 |
| 15282 | 0.003 |
| 15283 | 0.002 |
| 15284 | 0.009 |
| 15285 | 0.001 |
| 15286 | 0.008 |
| 15287 | 0.006 |
| 15288 | 0.006 |
| 15289 | 0.003 |
| 15290 | 0.004 |
| 15291 | 0.006 |
| 15292 | 0.002 |
| 15293 | 0.002 |
| 15294 | 0.002 |
| 15295 | 0.007 |
| 15296 | 0.009 |
| 15297 | 0.001 |
| 15298 | 0.004 |
| 15299 | 0.009 |
| 15300 | 0.005 |
| 15301 | 0.002 |
| 15302 | 0.003 |
| 15303 | 0.003 |
| 15304 | 0.004 |
| 15305 | 0.002 |
| 15306 | 0.002 |
| 15307 | 0.003 |
| 15308 | 0.003 |
| 15309 | 0.009 |
| 15310 | 0.001 |
| 15311 | 0.005 |
| 15312 | 0.009 |
| 15313 | 0.011 |
| 15314 | 0.003 |
| 15315 | 0.003 |
| 15316 | 0.002 |
| 15317 | 0.007 |
| 15318 | 0.002 |
| 15319 | 0.003 |
| 15320 | 0.005 |
| 15321 | 0.005 |
| 15322 | 0.001 |
| 15323 | 0.002 |
| 15324 | 0.006 |
| 15325 | 0.008 |
| 15326 | 0.001 |
| 15327 | 0.003 |
| 15328 | 0.007 |
| 15329 | 0.002 |
| 15330 | 0.005 |
| 15331 | 0.009 |
| 15332 | 0.003 |
| 15333 | 0.002 |
| 15334 | 0.004 |
| 15335 | 0.007 |
| 15336 | 0.003 |
| 15337 | 0.005 |
| 15338 | 0.008 |
| 15339 | 0.007 |
| 15340 | 0.01 |
| 15341 | 0.005 |
| 15342 | 0.006 |
| 15343 | 0.005 |
| 15344 | 0.007 |
| 15345 | 0.003 |
| 15346 | 0.003 |
| 15347 | 0.006 |
| 15348 | 0.005 |
| 15349 | 0.006 |
| 15350 | 0.004 |
| 15351 | 0.005 |
| 15352 | 0.007 |
| 15353 | 0.009 |
| 15354 | 0.004 |
| 15355 | 0.003 |
| 15356 | 0.003 |
| 15357 | 0.002 |
| 15358 | 0.005 |
| 15359 | 0.007 |
| 15360 | 0.002 |
| 15361 | 0.001 |
| 15362 | 0.006 |
| 15363 | 0.003 |
| 15364 | 0.006 |
| 15365 | 0.008 |
| 15366 | 0.01 |
| 15367 | 0.01 |
| 15368 | 0.002 |
| 15369 | 0.004 |
| 15370 | 0.009 |
| 15371 | 0.005 |
| 15372 | 0.009 |
| 15373 | 0.005 |
| 15374 | 0.002 |
| 15375 | 0.007 |
| 15376 | 0.007 |
| 15377 | 0.007 |
| 15378 | 0.002 |
| 15379 | 0.004 |
| 15380 | 0.006 |
| 15381 | 0.009 |
| 15382 | 0.01 |
| 15383 | 0.006 |
| 15384 | 0.006 |
| 15385 | 0.01 |
| 15386 | 0.004 |
| 15387 | 0.008 |
| 15388 | 0.002 |
| 15389 | 0.002 |
| 15390 | 0.005 |
| 15391 | 0.003 |
| 15392 | 0.002 |
| 15393 | 0.004 |
| 15394 | 0.004 |
| 15395 | 0.005 |
| 15396 | 0.008 |
| 15397 | 0.008 |
| 15398 | 0.007 |
| 15399 | 0.006 |
| 15400 | 0.005 |
| 15401 | 0.004 |
| 15402 | 0.004 |
| 15403 | 0.003 |
| 15404 | 0.002 |
| 15405 | 0.005 |
| 15406 | 0.004 |
| 15407 | 0.008 |
| 15408 | 0.004 |
| 15409 | 0.003 |
| 15410 | 0.007 |
| 15411 | 0.011 |
| 15412 | 0.004 |
| 15413 | 0.007 |
| 15414 | 0.008 |
| 15415 | 0.004 |
| 15416 | 0.004 |
| 15417 | 0.006 |
| 15418 | 0.002 |
| 15419 | 0.002 |
| 15420 | 0.011 |
| 15421 | 0.003 |
| 15422 | 0.004 |
| 15423 | 0.002 |
| 15424 | 0.005 |
| 15425 | 0.009 |
| 15426 | 0.002 |
| 15427 | 0.004 |
| 15428 | 0.004 |
| 15429 | 0.006 |
| 15430 | 0.003 |
| 15431 | 0.006 |
| 15432 | 0.004 |
| 15433 | 0.01 |
| 15434 | 0.005 |
| 15435 | 0.004 |
| 15436 | 0.003 |
| 15437 | 0.002 |
| 15438 | 0.002 |
| 15439 | 0.003 |
| 15440 | 0.006 |
| 15441 | 0.005 |
| 15442 | 0.004 |
| 15443 | 0.002 |
| 15444 | 0.003 |
| 15445 | 0.007 |
| 15446 | 0.001 |
| 15447 | 0.004 |
| 15448 | 0.007 |
| 15449 | 0.006 |
| 15450 | 0.003 |
| 15451 | 0.003 |
| 15452 | 0.001 |
| 15453 | 0.01 |
| 15454 | 0.003 |
| 15455 | 0.003 |
| 15456 | 0.003 |
| 15457 | 0.004 |
| 15458 | 0.003 |
| 15459 | 0.004 |
| 15460 | 0.002 |
| 15461 | 0.004 |
| 15462 | 0.005 |
| 15463 | 0.005 |
| 15464 | 0.007 |
| 15465 | 0.009 |
| 15466 | 0.002 |
| 15467 | 0.004 |
| 15468 | 0.003 |
| 15469 | 0.004 |
| 15470 | 0.002 |
| 15471 | 0.001 |
| 15472 | 0.007 |
| 15473 | 0.008 |
| 15474 | 0.002 |
| 15475 | 0.005 |
| 15476 | 0.004 |
| 15477 | 0.005 |
| 15478 | 0.002 |
| 15479 | 0.001 |
| 15480 | 0.003 |
| 15481 | 0.002 |
| 15482 | 0.004 |
| 15483 | 0.004 |
| 15484 | 0.007 |
| 15485 | 0.002 |
| 15486 | 0.002 |
| 15487 | 0.001 |
| 15488 | 0.002 |
| 15489 | 0.005 |
| 15490 | 0.005 |
| 15491 | 0.003 |
| 15492 | 0.002 |
| 15493 | 0.002 |
| 15494 | 0.001 |
| 15495 | 0.003 |
| 15496 | 0.005 |
| 15497 | 0.006 |
| 15498 | 0.002 |
| 15499 | 0.007 |
| 15500 | 0.008 |
| 15501 | 0.006 |
| 15502 | 0.001 |
| 15503 | 0.003 |
| 15504 | 0.004 |
| 15505 | 0.006 |
| 15506 | 0.005 |
| 15507 | 0.004 |
| 15508 | 0.008 |
| 15509 | 0.006 |
| 15510 | 0.004 |
| 15511 | 0.002 |
| 15512 | 0.001 |
| 15513 | 0.002 |
| 15514 | 0.001 |
| 15515 | 0.001 |
| 15516 | 0.002 |
| 15517 | 0.006 |
| 15518 | 0.001 |
| 15519 | 0.002 |
| 15520 | 0.006 |
| 15521 | 0.001 |
| 15522 | 0.002 |
| 15523 | 0.003 |
| 15524 | 0.002 |
| 15525 | 0.003 |
| 15526 | 0.002 |
| 15527 | 0.001 |
| 15528 | 0.002 |
| 15529 | 0.004 |
| 15530 | 0.006 |
| 15531 | 0.001 |
| 15532 | 0.003 |
| 15533 | 0.007 |
| 15534 | 0.003 |
| 15535 | 0.006 |
| 15536 | 0.004 |
| 15537 | 0.005 |
| 15538 | 0.001 |
| 15539 | 0.004 |
| 15540 | 0.007 |
| 15541 | 0.009 |
| 15542 | 0.004 |
| 15543 | 0.003 |
| 15544 | 0.003 |
| 15545 | 0.003 |
| 15546 | 0.002 |
| 15547 | 0.004 |
| 15548 | 0.002 |
| 15549 | 0.006 |
| 15550 | 0.002 |
| 15551 | 0.002 |
| 15552 | 0.006 |
| 15553 | 0.006 |
| 15554 | 0.002 |
| 15555 | 0.004 |
| 15556 | 0.008 |
| 15557 | 0.003 |
| 15558 | 0.002 |
| 15559 | 0.004 |
| 15560 | 0.002 |
| 15561 | 0.005 |
| 15562 | 0.002 |
| 15563 | 0.006 |
| 15564 | 0.004 |
| 15565 | 0.002 |
| 15566 | 0.003 |
| 15567 | 0.002 |
| 15568 | 0.003 |
| 15569 | 0.002 |
| 15570 | 0.001 |
| 15571 | 0.003 |
| 15572 | 0.009 |
| 15573 | 0.007 |
| 15574 | 0.002 |
| 15575 | 0.003 |
| 15576 | 0.007 |
| 15577 | 0.004 |
| 15578 | 0.002 |
| 15579 | 0.004 |
| 15580 | 0.005 |
| 15581 | 0.005 |
| 15582 | 0.004 |
| 15583 | 0.002 |
| 15584 | 0.005 |
| 15585 | 0.003 |
| 15586 | 0.003 |
| 15587 | 0.006 |
| 15588 | 0.008 |
| 15589 | 0.004 |
| 15590 | 0.005 |
| 15591 | 0.001 |
| 15592 | 0.004 |
| 15593 | 0.007 |
| 15594 | 0.004 |
| 15595 | 0.001 |
| 15596 | 0.007 |
| 15597 | 0.009 |
| 15598 | 0.002 |
| 15599 | 0.004 |
| 15600 | 0.003 |
| 15601 | 0.003 |
| 15602 | 0.002 |
| 15603 | 0.006 |
| 15604 | 0.01 |
| 15605 | 0.002 |
| 15606 | 0.005 |
| 15607 | 0.006 |
| 15608 | 0.005 |
| 15609 | 0.007 |
| 15610 | 0.001 |
| 15611 | 0.004 |
| 15612 | 0.007 |
| 15613 | 0.002 |
| 15614 | 0.003 |
| 15615 | 0.004 |
| 15616 | 0.004 |
| 15617 | 0.002 |
| 15618 | 0.007 |
| 15619 | 0.004 |
| 15620 | 0.002 |
| 15621 | 0.005 |
| 15622 | 0.003 |
| 15623 | 0.003 |
| 15624 | 0.005 |
| 15625 | 0.001 |
| 15626 | 0.006 |
| 15627 | 0.001 |
| 15628 | 0.001 |
| 15629 | 0.003 |
| 15630 | 0.003 |
| 15631 | 0.003 |
| 15632 | 0.003 |
| 15633 | 0.004 |
| 15634 | 0.001 |
| 15635 | 0.008 |
| 15636 | 0.006 |
| 15637 | 0.004 |
| 15638 | 0.003 |
| 15639 | 0.006 |
| 15640 | 0.007 |
| 15641 | 0.004 |
| 15642 | 0.003 |
| 15643 | 0.001 |
| 15644 | 0.01 |
| 15645 | 0.007 |
| 15646 | 0.01 |
| 15647 | 0.004 |
| 15648 | 0.006 |
| 15649 | 0.008 |
| 15650 | 0.008 |
| 15651 | 0.009 |
| 15652 | 0.011 |
| 15653 | 0.005 |
| 15654 | 0.006 |
| 15655 | 0.007 |
| 15656 | 0.003 |
| 15657 | 0.002 |
| 15658 | 0.005 |
| 15659 | 0.002 |
| 15660 | 0.008 |
| 15661 | 0.01 |
| 15662 | 0.009 |
| 15663 | 0.007 |
| 15664 | 0.001 |
| 15665 | 0.004 |
| 15666 | 0.004 |
| 15667 | 0.003 |
| 15668 | 0.002 |
| 15669 | 0.002 |
| 15670 | 0.005 |
| 15671 | 0.005 |
| 15672 | 0.008 |
| 15673 | 0.01 |
| 15674 | 0.004 |
| 15675 | 0.002 |
| 15676 | 0.004 |
| 15677 | 0.008 |
| 15678 | 0.008 |
| 15679 | 0.008 |
| 15680 | 0.002 |
| 15681 | 0.003 |
| 15682 | 0.005 |
| 15683 | 0.006 |
| 15684 | 0.007 |
| 15685 | 0.006 |
| 15686 | 0.005 |
| 15687 | 0.006 |
| 15688 | 0.007 |
| 15689 | 0.004 |
| 15690 | 0.005 |
| 15691 | 0.006 |
| 15692 | 0.006 |
| 15693 | 0.005 |
| 15694 | 0.007 |
| 15695 | 0.005 |
| 15696 | 0.003 |
| 15697 | 0.001 |
| 15698 | 0.002 |
| 15699 | 0.004 |
| 15700 | 0.003 |
| 15701 | 0.002 |
| 15702 | 0.001 |
| 15703 | 0.002 |
| 15704 | 0.002 |
| 15705 | 0.005 |
| 15706 | 0.002 |
| 15707 | 0.002 |
| 15708 | 0.004 |
| 15709 | 0.007 |
| 15710 | 0.002 |
| 15711 | 0.004 |
| 15712 | 0.005 |
| 15713 | 0.002 |
| 15714 | 0.003 |
| 15715 | 0.001 |
| 15716 | 0.009 |
| 15717 | 0.003 |
| 15718 | 0.003 |
| 15719 | 0.001 |
| 15720 | 0.005 |
| 15721 | 0.002 |
| 15722 | 0.006 |
| 15723 | 0.003 |
| 15724 | 0.005 |
| 15725 | 0.006 |
| 15726 | 0.004 |
| 15727 | 0.004 |
| 15728 | 0.008 |
| 15729 | 0.005 |
| 15730 | 0.003 |
| 15731 | 0.003 |
| 15732 | 0.002 |
| 15733 | 0.003 |
| 15734 | 0.002 |
| 15735 | 0.005 |
| 15736 | 0.002 |
| 15737 | 0.008 |
| 15738 | 0.002 |
| 15739 | 0.004 |
| 15740 | 0.003 |
| 15741 | 0.002 |
| 15742 | 0.001 |
| 15743 | 0.007 |
| 15744 | 0.005 |
| 15745 | 0.002 |
| 15746 | 0.005 |
| 15747 | 0.005 |
| 15748 | 0.001 |
| 15749 | 0.002 |
| 15750 | 0.002 |
| 15751 | 0.008 |
| 15752 | 0.003 |
| 15753 | 0.004 |
| 15754 | 0.004 |
| 15755 | 0.008 |
| 15756 | 0.007 |
| 15757 | 0.001 |
| 15758 | 0.003 |
| 15759 | 0.007 |
| 15760 | 0.012 |
| 15761 | 0.004 |
| 15762 | 0.002 |
| 15763 | 0.008 |
| 15764 | 0.008 |
| 15765 | 0.006 |
| 15766 | 0.006 |
| 15767 | 0.004 |
| 15768 | 0.004 |
| 15769 | 0.003 |
| 15770 | 0.001 |
| 15771 | 0.008 |
| 15772 | 0.005 |
| 15773 | 0.006 |
| 15774 | 0.003 |
| 15775 | 0.002 |
| 15776 | 0.005 |
| 15777 | 0.002 |
| 15778 | 0.002 |
| 15779 | 0.008 |
| 15780 | 0.007 |
| 15781 | 0.001 |
| 15782 | 0.002 |
| 15783 | 0.007 |
| 15784 | 0.002 |
| 15785 | 0 |
| 15786 | 0.003 |
| 15787 | 0.003 |
| 15788 | 0.004 |
| 15789 | 0.001 |
| 15790 | 0.004 |
| 15791 | 0.004 |
| 15792 | 0.003 |
| 15793 | 0.003 |
| 15794 | 0.003 |
| 15795 | 0.002 |
| 15796 | 0.006 |
| 15797 | 0.003 |
| 15798 | 0.001 |
| 15799 | 0.005 |
| 15800 | 0.008 |
| 15801 | 0.003 |
| 15802 | 0.004 |
| 15803 | 0.003 |
| 15804 | 0.004 |
| 15805 | 0.002 |
| 15806 | 0.002 |
| 15807 | 0 |
| 15808 | 0.007 |
| 15809 | 0.004 |
| 15810 | 0.005 |
| 15811 | 0.004 |
| 15812 | 0.006 |
| 15813 | 0.002 |
| 15814 | 0.006 |
| 15815 | 0.008 |
| 15816 | 0.01 |
| 15817 | 0.005 |
| 15818 | 0.001 |
| 15819 | 0.003 |
| 15820 | 0.004 |
| 15821 | 0.002 |
| 15822 | 0.001 |
| 15823 | 0.002 |
| 15824 | 0.006 |
| 15825 | 0.002 |
| 15826 | 0.001 |
| 15827 | 0.003 |
| 15828 | 0.003 |
| 15829 | 0.003 |
| 15830 | 0.004 |
| 15831 | 0.008 |
| 15832 | 0.008 |
| 15833 | 0.002 |
| 15834 | 0.003 |
| 15835 | 0.006 |
| 15836 | 0.005 |
| 15837 | 0.002 |
| 15838 | 0.003 |
| 15839 | 0.004 |
| 15840 | 0.005 |
| 15841 | 0.001 |
| 15842 | 0.004 |
| 15843 | 0.004 |
| 15844 | 0.01 |
| 15845 | 0.004 |
| 15846 | 0.004 |
| 15847 | 0.004 |
| 15848 | 0.001 |
| 15849 | 0.001 |
| 15850 | 0.003 |
| 15851 | 0.003 |
| 15852 | 0.012 |
| 15853 | 0.001 |
| 15854 | 0.003 |
| 15855 | 0.01 |
| 15856 | 0.008 |
| 15857 | 0.002 |
| 15858 | 0.004 |
| 15859 | 0.005 |
| 15860 | 0.007 |
| 15861 | 0.002 |
| 15862 | 0.003 |
| 15863 | 0.005 |
| 15864 | 0.007 |
| 15865 | 0.002 |
| 15866 | 0.006 |
| 15867 | 0.006 |
| 15868 | 0.005 |
| 15869 | 0.002 |
| 15870 | 0.005 |
| 15871 | 0.003 |
| 15872 | 0.006 |
| 15873 | 0.003 |
| 15874 | 0.002 |
| 15875 | 0.004 |
| 15876 | 0.007 |
| 15877 | 0.003 |
| 15878 | 0.001 |
| 15879 | 0.004 |
| 15880 | 0.003 |
| 15881 | 0.002 |
| 15882 | 0.002 |
| 15883 | 0.002 |
| 15884 | 0.005 |
| 15885 | 0.002 |
| 15886 | 0.003 |
| 15887 | 0.007 |
| 15888 | 0.003 |
| 15889 | 0.002 |
| 15890 | 0.003 |
| 15891 | 0.002 |
| 15892 | 0.002 |
| 15893 | 0.005 |
| 15894 | 0.001 |
| 15895 | 0.002 |
| 15896 | 0.002 |
| 15897 | 0.005 |
| 15898 | 0.002 |
| 15899 | 0.004 |
| 15900 | 0.005 |
| 15901 | 0.004 |
| 15902 | 0.003 |
| 15903 | 0.001 |
| 15904 | 0.006 |
| 15905 | 0.002 |
| 15906 | 0.001 |
| 15907 | 0.003 |
| 15908 | 0.004 |
| 15909 | 0.003 |
| 15910 | 0.004 |
| 15911 | 0.002 |
| 15912 | 0.001 |
| 15913 | 0.002 |
| 15914 | 0.001 |
| 15915 | 0.004 |
| 15916 | 0.004 |
| 15917 | 0.001 |
| 15918 | 0.006 |
| 15919 | 0.002 |
| 15920 | 0.002 |
| 15921 | 0.002 |
| 15922 | 0.003 |
| 15923 | 0.004 |
| 15924 | 0.003 |
| 15925 | 0.007 |
| 15926 | 0.003 |
| 15927 | 0.004 |
| 15928 | 0.002 |
| 15929 | 0.002 |
| 15930 | 0.004 |
| 15931 | 0.003 |
| 15932 | 0.002 |
| 15933 | 0.002 |
| 15934 | 0.008 |
| 15935 | 0.002 |
| 15936 | 0.003 |
| 15937 | 0.001 |
| 15938 | 0.002 |
| 15939 | 0.003 |
| 15940 | 0.003 |
| 15941 | 0.003 |
| 15942 | 0.009 |
| 15943 | 0.005 |
| 15944 | 0.004 |
| 15945 | 0.005 |
| 15946 | 0.004 |
| 15947 | 0.002 |
| 15948 | 0.002 |
| 15949 | 0.001 |
| 15950 | 0.002 |
| 15951 | 0.007 |
| 15952 | 0.006 |
| 15953 | 0.005 |
| 15954 | 0.007 |
| 15955 | 0.003 |
| 15956 | 0.003 |
| 15957 | 0.003 |
| 15958 | 0.009 |
| 15959 | 0.006 |
| 15960 | 0.005 |
| 15961 | 0.002 |
| 15962 | 0.004 |
| 15963 | 0.009 |
| 15964 | 0.01 |
| 15965 | 0.007 |
| 15966 | 0.004 |
| 15967 | 0.001 |
| 15968 | 0.002 |
| 15969 | 0.005 |
| 15970 | 0.004 |
| 15971 | 0.003 |
| 15972 | 0.006 |
| 15973 | 0.003 |
| 15974 | 0.01 |
| 15975 | 0.01 |
| 15976 | 0.006 |
| 15977 | 0.004 |
| 15978 | 0.005 |
| 15979 | 0.008 |
| 15980 | 0.002 |
| 15981 | 0.01 |
| 15982 | 0.006 |
| 15983 | 0.007 |
| 15984 | 0.005 |
| 15985 | 0.005 |
| 15986 | 0.003 |
| 15987 | 0.003 |
| 15988 | 0.002 |
| 15989 | 0.002 |
| 15990 | 0.002 |
| 15991 | 0.005 |
| 15992 | 0.001 |
| 15993 | 0.004 |
| 15994 | 0.005 |
| 15995 | 0.001 |
| 15996 | 0.005 |
| 15997 | 0.002 |
| 15998 | 0.002 |
| 15999 | 0.003 |
| 16000 | 0.006 |
| 16001 | 0.003 |
| 16002 | 0.003 |
| 16003 | 0.004 |
| 16004 | 0.009 |
| 16005 | 0.002 |
| 16006 | 0.003 |
| 16007 | 0.004 |
| 16008 | 0.004 |
| 16009 | 0.002 |
| 16010 | 0.003 |
| 16011 | 0.007 |
| 16012 | 0.004 |
| 16013 | 0.003 |
| 16014 | 0.004 |
| 16015 | 0.004 |
| 16016 | 0.004 |
| 16017 | 0.007 |
| 16018 | 0.004 |
| 16019 | 0.003 |
| 16020 | 0.003 |
| 16021 | 0.006 |
| 16022 | 0.005 |
| 16023 | 0.007 |
| 16024 | 0.004 |
| 16025 | 0.009 |
| 16026 | 0.001 |
| 16027 | 0.004 |
| 16028 | 0.002 |
| 16029 | 0.004 |
| 16030 | 0.003 |
| 16031 | 0.006 |
| 16032 | 0.008 |
| 16033 | 0.006 |
| 16034 | 0.003 |
| 16035 | 0.002 |
| 16036 | 0.004 |
| 16037 | 0.003 |
| 16038 | 0.002 |
| 16039 | 0.004 |
| 16040 | 0.001 |
| 16041 | 0.002 |
| 16042 | 0.002 |
| 16043 | 0.002 |
| 16044 | 0.003 |
| 16045 | 0.002 |
| 16046 | 0.001 |
| 16047 | 0.002 |
| 16048 | 0.007 |
| 16049 | 0.006 |
| 16050 | 0.002 |
| 16051 | 0.003 |
| 16052 | 0.005 |
| 16053 | 0.006 |
| 16054 | 0.001 |
| 16055 | 0.003 |
| 16056 | 0.004 |
| 16057 | 0.005 |
| 16058 | 0.007 |
| 16059 | 0.002 |
| 16060 | 0.005 |
| 16061 | 0.004 |
| 16062 | 0.003 |
| 16063 | 0.004 |
| 16064 | 0.004 |
| 16065 | 0.004 |
| 16066 | 0.005 |
| 16067 | 0.001 |
| 16068 | 0.007 |
| 16069 | 0.007 |
| 16070 | 0.002 |
| 16071 | 0.003 |
| 16072 | 0.005 |
| 16073 | 0.006 |
| 16074 | 0.004 |
| 16075 | 0.003 |
| 16076 | 0.004 |
| 16077 | 0.003 |
| 16078 | 0.005 |
| 16079 | 0.001 |
| 16080 | 0.003 |
| 16081 | 0.011 |
| 16082 | 0.005 |
| 16083 | 0 |
| 16084 | 0.003 |
| 16085 | 0.007 |
| 16086 | 0.001 |
| 16087 | 0.005 |
| 16088 | 0.006 |
| 16089 | 0.005 |
| 16090 | 0.001 |
| 16091 | 0.002 |
| 16092 | 0.005 |
| 16093 | 0.003 |
| 16094 | 0.003 |
| 16095 | 0.003 |
| 16096 | 0.002 |
| 16097 | 0.005 |
| 16098 | 0.003 |
| 16099 | 0.006 |
| 16100 | 0.007 |
| 16101 | 0.006 |
| 16102 | 0.002 |
| 16103 | 0.003 |
| 16104 | 0.002 |
| 16105 | 0.002 |
| 16106 | 0.005 |
| 16107 | 0.005 |
| 16108 | 0.005 |
| 16109 | 0.004 |
| 16110 | 0.003 |
| 16111 | 0.005 |
| 16112 | 0.001 |
| 16113 | 0.003 |
| 16114 | 0.003 |
| 16115 | 0.004 |
| 16116 | 0.007 |
| 16117 | 0.006 |
| 16118 | 0.001 |
| 16119 | 0.002 |
| 16120 | 0.008 |
| 16121 | 0.005 |
| 16122 | 0.001 |
| 16123 | 0.002 |
| 16124 | 0.004 |
| 16125 | 0.008 |
| 16126 | 0.002 |
| 16127 | 0.003 |
| 16128 | 0.007 |
| 16129 | 0.002 |
| 16130 | 0.002 |
| 16131 | 0.004 |
| 16132 | 0.005 |
| 16133 | 0.008 |
| 16134 | 0.001 |
| 16135 | 0.004 |
| 16136 | 0.009 |
| 16137 | 0.01 |
| 16138 | 0.005 |
| 16139 | 0.005 |
| 16140 | 0.002 |
| 16141 | 0.006 |
| 16142 | 0.002 |
| 16143 | 0.002 |
| 16144 | 0.005 |
| 16145 | 0.005 |
| 16146 | 0.003 |
| 16147 | 0.005 |
| 16148 | 0.004 |
| 16149 | 0.002 |
| 16150 | 0.002 |
| 16151 | 0.004 |
| 16152 | 0.008 |
| 16153 | 0.004 |
| 16154 | 0.002 |
| 16155 | 0.003 |
| 16156 | 0.003 |
| 16157 | 0.006 |
| 16158 | 0.001 |
| 16159 | 0.006 |
| 16160 | 0.006 |
| 16161 | 0.001 |
| 16162 | 0.001 |
| 16163 | 0.006 |
| 16164 | 0.002 |
| 16165 | 0.002 |
| 16166 | 0.003 |
| 16167 | 0.003 |
| 16168 | 0.002 |
| 16169 | 0.005 |
| 16170 | 0.003 |
| 16171 | 0.006 |
| 16172 | 0.009 |
| 16173 | 0.008 |
| 16174 | 0.003 |
| 16175 | 0.006 |
| 16176 | 0.007 |
| 16177 | 0.009 |
| 16178 | 0.001 |
| 16179 | 0.002 |
| 16180 | 0.007 |
| 16181 | 0.004 |
| 16182 | 0.006 |
| 16183 | 0.004 |
| 16184 | 0.008 |
| 16185 | 0.006 |
| 16186 | 0.002 |
| 16187 | 0.003 |
| 16188 | 0.005 |
| 16189 | 0.003 |
| 16190 | 0.001 |
| 16191 | 0.005 |
| 16192 | 0.004 |
| 16193 | 0.008 |
| 16194 | 0.003 |
| 16195 | 0.005 |
| 16196 | 0.006 |
| 16197 | 0.004 |
| 16198 | 0.001 |
| 16199 | 0.007 |
| 16200 | 0.005 |
| 16201 | 0.007 |
| 16202 | 0.009 |
| 16203 | 0.002 |
| 16204 | 0.002 |
| 16205 | 0.005 |
| 16206 | 0.006 |
| 16207 | 0.001 |
| 16208 | 0.002 |
| 16209 | 0.007 |
| 16210 | 0.003 |
| 16211 | 0.002 |
| 16212 | 0.001 |
| 16213 | 0.007 |
| 16214 | 0.003 |
| 16215 | 0.003 |
| 16216 | 0.002 |
| 16217 | 0.006 |
| 16218 | 0.001 |
| 16219 | 0.003 |
| 16220 | 0.003 |
| 16221 | 0.003 |
| 16222 | 0.002 |
| 16223 | 0.004 |
| 16224 | 0.014 |
| 16225 | 0.007 |
| 16226 | 0.006 |
| 16227 | 0.005 |
| 16228 | 0.004 |
| 16229 | 0.007 |
| 16230 | 0.002 |
| 16231 | 0.007 |
| 16232 | 0.003 |
| 16233 | 0.004 |
| 16234 | 0.002 |
| 16235 | 0.002 |
| 16236 | 0.005 |
| 16237 | 0.007 |
| 16238 | 0.004 |
| 16239 | 0.005 |
| 16240 | 0.003 |
| 16241 | 0.004 |
| 16242 | 0.004 |
| 16243 | 0.004 |
| 16244 | 0.006 |
| 16245 | 0.002 |
| 16246 | 0.006 |
| 16247 | 0.005 |
| 16248 | 0.004 |
| 16249 | 0.006 |
| 16250 | 0.002 |
| 16251 | 0.006 |
| 16252 | 0.007 |
| 16253 | 0.005 |
| 16254 | 0.003 |
| 16255 | 0.006 |
| 16256 | 0.003 |
| 16257 | 0.008 |
| 16258 | 0.006 |
| 16259 | 0.006 |
| 16260 | 0.006 |
| 16261 | 0.009 |
| 16262 | 0.004 |
| 16263 | 0.004 |
| 16264 | 0.002 |
| 16265 | 0.005 |
| 16266 | 0.006 |
| 16267 | 0.003 |
| 16268 | 0.007 |
| 16269 | 0.008 |
| 16270 | 0.01 |
| 16271 | 0.005 |
| 16272 | 0.004 |
| 16273 | 0.002 |
| 16274 | 0.007 |
| 16275 | 0.01 |
| 16276 | 0.003 |
| 16277 | 0.004 |
| 16278 | 0.006 |
| 16279 | 0.004 |
| 16280 | 0.004 |
| 16281 | 0.004 |
| 16282 | 0.002 |
| 16283 | 0.003 |
| 16284 | 0.003 |
| 16285 | 0.007 |
| 16286 | 0.006 |
| 16287 | 0.005 |
| 16288 | 0.006 |
| 16289 | 0.002 |
| 16290 | 0.007 |
| 16291 | 0.005 |
| 16292 | 0.005 |
| 16293 | 0.003 |
| 16294 | 0.003 |
| 16295 | 0.004 |
| 16296 | 0.007 |
| 16297 | 0.005 |
| 16298 | 0.009 |
| 16299 | 0.012 |
| 16300 | 0.009 |
| 16301 | 0.004 |
| 16302 | 0.003 |
| 16303 | 0.005 |
| 16304 | 0.007 |
| 16305 | 0.003 |
| 16306 | 0.001 |
| 16307 | 0.005 |
| 16308 | 0.008 |
| 16309 | 0.002 |
| 16310 | 0.001 |
| 16311 | 0.007 |
| 16312 | 0.006 |
| 16313 | 0.001 |
| 16314 | 0.002 |
| 16315 | 0.004 |
| 16316 | 0.004 |
| 16317 | 0.013 |
| 16318 | 0.003 |
| 16319 | 0.001 |
| 16320 | 0.003 |
| 16321 | 0.004 |
| 16322 | 0.001 |
| 16323 | 0.002 |
| 16324 | 0.004 |
| 16325 | 0.009 |
| 16326 | 0.006 |
| 16327 | 0.007 |
| 16328 | 0.003 |
| 16329 | 0.002 |
| 16330 | 0.001 |
| 16331 | 0.002 |
| 16332 | 0.005 |
| 16333 | 0.004 |
| 16334 | 0.001 |
| 16335 | 0.002 |
| 16336 | 0.005 |
| 16337 | 0.005 |
| 16338 | 0.003 |
| 16339 | 0.003 |
| 16340 | 0.006 |
| 16341 | 0.009 |
| 16342 | 0.004 |
| 16343 | 0.003 |
| 16344 | 0.008 |
| 16345 | 0.003 |
| 16346 | 0.002 |
| 16347 | 0.002 |
| 16348 | 0.004 |
| 16349 | 0.005 |
| 16350 | 0.002 |
| 16351 | 0.006 |
| 16352 | 0.002 |
| 16353 | 0.002 |
| 16354 | 0.001 |
| 16355 | 0.002 |
| 16356 | 0.005 |
| 16357 | 0.005 |
| 16358 | 0.001 |
| 16359 | 0.003 |
| 16360 | 0.002 |
| 16361 | 0.004 |
| 16362 | 0.006 |
| 16363 | 0.005 |
| 16364 | 0.005 |
| 16365 | 0.003 |
| 16366 | 0.002 |
| 16367 | 0.002 |
| 16368 | 0.003 |
| 16369 | 0.006 |
| 16370 | 0.002 |
| 16371 | 0.001 |
| 16372 | 0.006 |
| 16373 | 0.009 |
| 16374 | 0.006 |
| 16375 | 0.005 |
| 16376 | 0.004 |
| 16377 | 0.003 |
| 16378 | 0.003 |
| 16379 | 0.008 |
| 16380 | 0.005 |
| 16381 | 0.001 |
| 16382 | 0.002 |
| 16383 | 0.003 |
| 16384 | 0.002 |
| 16385 | 0.003 |
| 16386 | 0.002 |
| 16387 | 0.005 |
| 16388 | 0.005 |
| 16389 | 0.005 |
| 16390 | 0.003 |
| 16391 | 0.003 |
| 16392 | 0.007 |
| 16393 | 0.003 |
| 16394 | 0.002 |
| 16395 | 0.003 |
| 16396 | 0.002 |
| 16397 | 0.006 |
| 16398 | 0.001 |
| 16399 | 0.002 |
| 16400 | 0.007 |
| 16401 | 0.01 |
| 16402 | 0.009 |
| 16403 | 0.006 |
| 16404 | 0.004 |
| 16405 | 0.003 |
| 16406 | 0.004 |
| 16407 | 0.007 |
| 16408 | 0.003 |
| 16409 | 0.001 |
| 16410 | 0.001 |
| 16411 | 0.003 |
| 16412 | 0.003 |
| 16413 | 0.003 |
| 16414 | 0.006 |
| 16415 | 0.004 |
| 16416 | 0.008 |
| 16417 | 0.003 |
| 16418 | 0.003 |
| 16419 | 0.005 |
| 16420 | 0.008 |
| 16421 | 0.002 |
| 16422 | 0.004 |
| 16423 | 0.004 |
| 16424 | 0.003 |
| 16425 | 0.002 |
| 16426 | 0.003 |
| 16427 | 0.006 |
| 16428 | 0.006 |
| 16429 | 0.003 |
| 16430 | 0.004 |
| 16431 | 0.004 |
| 16432 | 0.007 |
| 16433 | 0.001 |
| 16434 | 0.002 |
| 16435 | 0.003 |
| 16436 | 0.006 |
| 16437 | 0.002 |
| 16438 | 0.004 |
| 16439 | 0.005 |
| 16440 | 0.004 |
| 16441 | 0.003 |
| 16442 | 0.002 |
| 16443 | 0.004 |
| 16444 | 0.002 |
| 16445 | 0.001 |
| 16446 | 0.002 |
| 16447 | 0.008 |
| 16448 | 0.009 |
| 16449 | 0.003 |
| 16450 | 0.002 |
| 16451 | 0.005 |
| 16452 | 0.007 |
| 16453 | 0.005 |
| 16454 | 0.005 |
| 16455 | 0.002 |
| 16456 | 0.001 |
| 16457 | 0.001 |
| 16458 | 0.002 |
| 16459 | 0.006 |
| 16460 | 0.004 |
| 16461 | 0.004 |
| 16462 | 0.003 |
| 16463 | 0.005 |
| 16464 | 0.004 |
| 16465 | 0.004 |
| 16466 | 0.004 |
| 16467 | 0.004 |
| 16468 | 0.004 |
| 16469 | 0.004 |
| 16470 | 0.008 |
| 16471 | 0.004 |
| 16472 | 0.006 |
| 16473 | 0.007 |
| 16474 | 0.003 |
| 16475 | 0.003 |
| 16476 | 0.005 |
| 16477 | 0.004 |
| 16478 | 0.002 |
| 16479 | 0.004 |
| 16480 | 0.005 |
| 16481 | 0.002 |
| 16482 | 0.002 |
| 16483 | 0.005 |
| 16484 | 0.004 |
| 16485 | 0.004 |
| 16486 | 0.003 |
| 16487 | 0.002 |
| 16488 | 0.002 |
| 16489 | 0.007 |
| 16490 | 0.003 |
| 16491 | 0.002 |
| 16492 | 0.003 |
| 16493 | 0.001 |
| 16494 | 0.005 |
| 16495 | 0.002 |
| 16496 | 0.012 |
| 16497 | 0.004 |
| 16498 | 0.003 |
| 16499 | 0.004 |
| 16500 | 0.001 |
| 16501 | 0.009 |
| 16502 | 0.001 |
| 16503 | 0.005 |
| 16504 | 0.002 |
| 16505 | 0.003 |
| 16506 | 0.006 |
| 16507 | 0.001 |
| 16508 | 0.004 |
| 16509 | 0.003 |
| 16510 | 0.005 |
| 16511 | 0.002 |
| 16512 | 0.001 |
| 16513 | 0.002 |
| 16514 | 0.002 |
| 16515 | 0.002 |
| 16516 | 0.003 |
| 16517 | 0.003 |
| 16518 | 0.012 |
| 16519 | 0.005 |
| 16520 | 0.007 |
| 16521 | 0.003 |
| 16522 | 0.004 |
| 16523 | 0.002 |
| 16524 | 0.003 |
| 16525 | 0.003 |
| 16526 | 0.003 |
| 16527 | 0.002 |
| 16528 | 0.001 |
| 16529 | 0.001 |
| 16530 | 0.002 |
| 16531 | 0.006 |
| 16532 | 0.007 |
| 16533 | 0.006 |
| 16534 | 0.001 |
| 16535 | 0.001 |
| 16536 | 0.006 |
| 16537 | 0.003 |
| 16538 | 0.007 |
| 16539 | 0.002 |
| 16540 | 0.008 |
| 16541 | 0.006 |
| 16542 | 0.003 |
| 16543 | 0.009 |
| 16544 | 0.005 |
| 16545 | 0.002 |
| 16546 | 0.007 |
| 16547 | 0.007 |
| 16548 | 0.002 |
| 16549 | 0.003 |
| 16550 | 0.005 |
| 16551 | 0.004 |
| 16552 | 0.006 |
| 16553 | 0.003 |
| 16554 | 0.011 |
| 16555 | 0.007 |
| 16556 | 0.003 |
| 16557 | 0.003 |
| 16558 | 0.001 |
| 16559 | 0.007 |
| 16560 | 0.002 |
| 16561 | 0.004 |
| 16562 | 0.004 |
| 16563 | 0.001 |
| 16564 | 0.003 |
| 16565 | 0.004 |
| 16566 | 0.009 |
| 16567 | 0.004 |
| 16568 | 0.008 |
| 16569 | 0.013 |
| 16570 | 0.003 |
| 16571 | 0.005 |
| 16572 | 0.002 |
| 16573 | 0.005 |
| 16574 | 0.009 |
| 16575 | 0.005 |
| 16576 | 0.008 |
| 16577 | 0.006 |
| 16578 | 0.004 |
| 16579 | 0.003 |
| 16580 | 0.004 |
| 16581 | 0.006 |
| 16582 | 0.006 |
| 16583 | 0.007 |
| 16584 | 0.004 |
| 16585 | 0.002 |
| 16586 | 0.004 |
| 16587 | 0.006 |
| 16588 | 0.006 |
| 16589 | 0.003 |
| 16590 | 0.003 |
| 16591 | 0.003 |
| 16592 | 0.008 |
| 16593 | 0.001 |
| 16594 | 0.004 |
| 16595 | 0.006 |
| 16596 | 0.007 |
| 16597 | 0.004 |
| 16598 | 0.002 |
| 16599 | 0.004 |
| 16600 | 0.005 |
| 16601 | 0.003 |
| 16602 | 0.005 |
| 16603 | 0.004 |
| 16604 | 0.003 |
| 16605 | 0.001 |
| 16606 | 0.002 |
| 16607 | 0.004 |
| 16608 | 0.007 |
| 16609 | 0.003 |
| 16610 | 0.004 |
| 16611 | 0.006 |
| 16612 | 0.007 |
| 16613 | 0.005 |
| 16614 | 0.01 |
| 16615 | 0.012 |
| 16616 | 0.014 |
| 16617 | 0.003 |
| 16618 | 0.002 |
| 16619 | 0.005 |
| 16620 | 0.004 |
| 16621 | 0.001 |
| 16622 | 0.004 |
| 16623 | 0.003 |
| 16624 | 0.004 |
| 16625 | 0.003 |
| 16626 | 0.002 |
| 16627 | 0.007 |
| 16628 | 0.002 |
| 16629 | 0.003 |
| 16630 | 0.003 |
| 16631 | 0.003 |
| 16632 | 0.003 |
| 16633 | 0.005 |
| 16634 | 0.002 |
| 16635 | 0.002 |
| 16636 | 0.006 |
| 16637 | 0.005 |
| 16638 | 0.001 |
| 16639 | 0.002 |
| 16640 | 0.009 |
| 16641 | 0.003 |
| 16642 | 0.002 |
| 16643 | 0.003 |
| 16644 | 0.004 |
| 16645 | 0.005 |
| 16646 | 0.001 |
| 16647 | 0.003 |
| 16648 | 0.005 |
| 16649 | 0.003 |
| 16650 | 0.001 |
| 16651 | 0.001 |
| 16652 | 0.002 |
| 16653 | 0.002 |
| 16654 | 0.004 |
| 16655 | 0.006 |
| 16656 | 0.006 |
| 16657 | 0.007 |
| 16658 | 0.003 |
| 16659 | 0.003 |
| 16660 | 0.003 |
| 16661 | 0.002 |
| 16662 | 0.002 |
| 16663 | 0.002 |
| 16664 | 0.004 |
| 16665 | 0.001 |
| 16666 | 0.003 |
| 16667 | 0.001 |
| 16668 | 0.009 |
| 16669 | 0.007 |
| 16670 | 0.001 |
| 16671 | 0.002 |
| 16672 | 0.001 |
| 16673 | 0.003 |
| 16674 | 0.004 |
| 16675 | 0.001 |
| 16676 | 0.002 |
| 16677 | 0.003 |
| 16678 | 0.003 |
| 16679 | 0.001 |
| 16680 | 0.003 |
| 16681 | 0.008 |
| 16682 | 0.006 |
| 16683 | 0.004 |
| 16684 | 0.009 |
| 16685 | 0.007 |
| 16686 | 0.002 |
| 16687 | 0.003 |
| 16688 | 0.009 |
| 16689 | 0.003 |
| 16690 | 0.004 |
| 16691 | 0.003 |
| 16692 | 0.004 |
| 16693 | 0.012 |
| 16694 | 0.004 |
| 16695 | 0.002 |
| 16696 | 0.001 |
| 16697 | 0.006 |
| 16698 | 0.003 |
| 16699 | 0.004 |
| 16700 | 0.006 |
| 16701 | 0.005 |
| 16702 | 0.002 |
| 16703 | 0.006 |
| 16704 | 0.003 |
| 16705 | 0.006 |
| 16706 | 0.002 |
| 16707 | 0.006 |
| 16708 | 0.003 |
| 16709 | 0.002 |
| 16710 | 0.003 |
| 16711 | 0.006 |
| 16712 | 0.005 |
| 16713 | 0.01 |
| 16714 | 0.003 |
| 16715 | 0.004 |
| 16716 | 0.002 |
| 16717 | 0.004 |
| 16718 | 0.003 |
| 16719 | 0.003 |
| 16720 | 0.003 |
| 16721 | 0.003 |
| 16722 | 0.003 |
| 16723 | 0.008 |
| 16724 | 0.007 |
| 16725 | 0.009 |
| 16726 | 0.001 |
| 16727 | 0.005 |
| 16728 | 0.003 |
| 16729 | 0.004 |
| 16730 | 0.001 |
| 16731 | 0.005 |
| 16732 | 0.01 |
| 16733 | 0.003 |
| 16734 | 0.003 |
| 16735 | 0.005 |
| 16736 | 0.006 |
| 16737 | 0.001 |
| 16738 | 0.003 |
| 16739 | 0.005 |
| 16740 | 0.005 |
| 16741 | 0.007 |
| 16742 | 0.004 |
| 16743 | 0.004 |
| 16744 | 0.005 |
| 16745 | 0.002 |
| 16746 | 0.002 |
| 16747 | 0 |
| 16748 | 0.006 |
| 16749 | 0.007 |
| 16750 | 0.004 |
| 16751 | 0.003 |
| 16752 | 0.002 |
| 16753 | 0.004 |
| 16754 | 0.002 |
| 16755 | 0.003 |
| 16756 | 0.003 |
| 16757 | 0.004 |
| 16758 | 0.002 |
| 16759 | 0.002 |
| 16760 | 0.008 |
| 16761 | 0.007 |
| 16762 | 0.002 |
| 16763 | 0.004 |
| 16764 | 0.003 |
| 16765 | 0.008 |
| 16766 | 0.002 |
| 16767 | 0.003 |
| 16768 | 0.002 |
| 16769 | 0.006 |
| 16770 | 0.002 |
| 16771 | 0.002 |
| 16772 | 0.005 |
| 16773 | 0.006 |
| 16774 | 0.003 |
| 16775 | 0.007 |
| 16776 | 0.005 |
| 16777 | 0.004 |
| 16778 | 0.004 |
| 16779 | 0.003 |
| 16780 | 0.005 |
| 16781 | 0.01 |
| 16782 | 0.004 |
| 16783 | 0.003 |
| 16784 | 0.004 |
| 16785 | 0.003 |
| 16786 | 0.003 |
| 16787 | 0.004 |
| 16788 | 0.002 |
| 16789 | 0.005 |
| 16790 | 0.002 |
| 16791 | 0.001 |
| 16792 | 0.006 |
| 16793 | 0.004 |
| 16794 | 0.001 |
| 16795 | 0.002 |
| 16796 | 0.003 |
| 16797 | 0.007 |
| 16798 | 0.004 |
| 16799 | 0.004 |
| 16800 | 0.002 |
| 16801 | 0.004 |
| 16802 | 0.005 |
| 16803 | 0.003 |
| 16804 | 0.003 |
| 16805 | 0.004 |
| 16806 | 0.003 |
| 16807 | 0.004 |
| 16808 | 0.002 |
| 16809 | 0.004 |
| 16810 | 0.002 |
| 16811 | 0.004 |
| 16812 | 0.003 |
| 16813 | 0.002 |
| 16814 | 0.008 |
| 16815 | 0.003 |
| 16816 | 0.004 |
| 16817 | 0.005 |
| 16818 | 0.003 |
| 16819 | 0.007 |
| 16820 | 0.006 |
| 16821 | 0.001 |
| 16822 | 0.008 |
| 16823 | 0.005 |
| 16824 | 0.003 |
| 16825 | 0.005 |
| 16826 | 0.009 |
| 16827 | 0.009 |
| 16828 | 0.005 |
| 16829 | 0.006 |
| 16830 | 0.009 |
| 16831 | 0.009 |
| 16832 | 0.005 |
| 16833 | 0.006 |
| 16834 | 0.002 |
| 16835 | 0.002 |
| 16836 | 0.002 |
| 16837 | 0.005 |
| 16838 | 0.003 |
| 16839 | 0.006 |
| 16840 | 0.001 |
| 16841 | 0.001 |
| 16842 | 0.008 |
| 16843 | 0.01 |
| 16844 | 0.004 |
| 16845 | 0.003 |
| 16846 | 0.006 |
| 16847 | 0.005 |
| 16848 | 0.006 |
| 16849 | 0.001 |
| 16850 | 0.008 |
| 16851 | 0.008 |
| 16852 | 0.005 |
| 16853 | 0.003 |
| 16854 | 0.003 |
| 16855 | 0.005 |
| 16856 | 0.004 |
| 16857 | 0.003 |
| 16858 | 0.001 |
| 16859 | 0.003 |
| 16860 | 0.01 |
| 16861 | 0.008 |
| 16862 | 0.008 |
| 16863 | 0.006 |
| 16864 | 0.004 |
| 16865 | 0.002 |
| 16866 | 0.001 |
| 16867 | 0.007 |
| 16868 | 0.007 |
| 16869 | 0.004 |
| 16870 | 0.002 |
| 16871 | 0.005 |
| 16872 | 0.004 |
| 16873 | 0.005 |
| 16874 | 0.005 |
| 16875 | 0.006 |
| 16876 | 0.005 |
| 16877 | 0.006 |
| 16878 | 0.002 |
| 16879 | 0.002 |
| 16880 | 0.008 |
| 16881 | 0.002 |
| 16882 | 0.003 |
| 16883 | 0.002 |
| 16884 | 0.002 |
| 16885 | 0.003 |
| 16886 | 0.005 |
| 16887 | 0.004 |
| 16888 | 0.002 |
| 16889 | 0.008 |
| 16890 | 0.005 |
| 16891 | 0.002 |
| 16892 | 0.004 |
| 16893 | 0.007 |
| 16894 | 0.003 |
| 16895 | 0.002 |
| 16896 | 0.005 |
| 16897 | 0.002 |
| 16898 | 0.002 |
| 16899 | 0.002 |
| 16900 | 0.009 |
| 16901 | 0.009 |
| 16902 | 0.003 |
| 16903 | 0.002 |
| 16904 | 0.005 |
| 16905 | 0.004 |
| 16906 | 0.002 |
| 16907 | 0.003 |
| 16908 | 0.004 |
| 16909 | 0.011 |
| 16910 | 0.002 |
| 16911 | 0.008 |
| 16912 | 0.01 |
| 16913 | 0.006 |
| 16914 | 0.003 |
| 16915 | 0.003 |
| 16916 | 0.009 |
| 16917 | 0.002 |
| 16918 | 0.004 |
| 16919 | 0.003 |
| 16920 | 0.005 |
| 16921 | 0.012 |
| 16922 | 0.005 |
| 16923 | 0.003 |
| 16924 | 0.007 |
| 16925 | 0.011 |
| 16926 | 0.004 |
| 16927 | 0.004 |
| 16928 | 0.008 |
| 16929 | 0.004 |
| 16930 | 0.001 |
| 16931 | 0.002 |
| 16932 | 0.003 |
| 16933 | 0.003 |
| 16934 | 0.004 |
| 16935 | 0.002 |
| 16936 | 0.001 |
| 16937 | 0.001 |
| 16938 | 0.003 |
| 16939 | 0.002 |
| 16940 | 0.007 |
| 16941 | 0.011 |
| 16942 | 0.001 |
| 16943 | 0.004 |
| 16944 | 0.005 |
| 16945 | 0.004 |
| 16946 | 0.006 |
| 16947 | 0.007 |
| 16948 | 0.006 |
| 16949 | 0.003 |
| 16950 | 0.002 |
| 16951 | 0.008 |
| 16952 | 0.009 |
| 16953 | 0.004 |
| 16954 | 0.004 |
| 16955 | 0.005 |
| 16956 | 0.005 |
| 16957 | 0.003 |
| 16958 | 0.002 |
| 16959 | 0.007 |
| 16960 | 0.006 |
| 16961 | 0.001 |
| 16962 | 0.003 |
| 16963 | 0.007 |
| 16964 | 0.005 |
| 16965 | 0.002 |
| 16966 | 0.003 |
| 16967 | 0.008 |
| 16968 | 0.004 |
| 16969 | 0.006 |
| 16970 | 0.002 |
| 16971 | 0.005 |
| 16972 | 0.002 |
| 16973 | 0.003 |
| 16974 | 0.003 |
| 16975 | 0.004 |
| 16976 | 0.004 |
| 16977 | 0.003 |
| 16978 | 0.002 |
| 16979 | 0.007 |
| 16980 | 0.003 |
| 16981 | 0.005 |
| 16982 | 0.003 |
| 16983 | 0.002 |
| 16984 | 0.01 |
| 16985 | 0.004 |
| 16986 | 0.005 |
| 16987 | 0.005 |
| 16988 | 0.004 |
| 16989 | 0.01 |
| 16990 | 0.004 |
| 16991 | 0.004 |
| 16992 | 0.003 |
| 16993 | 0.012 |
| 16994 | 0.002 |
| 16995 | 0.002 |
| 16996 | 0.002 |
| 16997 | 0.003 |
| 16998 | 0.002 |
| 16999 | 0.002 |
| 17000 | 0.001 |
| 17001 | 0.004 |
| 17002 | 0.006 |
| 17003 | 0.011 |
| 17004 | 0.007 |
| 17005 | 0.003 |
| 17006 | 0.003 |
| 17007 | 0.006 |
| 17008 | 0.009 |
| 17009 | 0.004 |
| 17010 | 0.003 |
| 17011 | 0.002 |
| 17012 | 0.004 |
| 17013 | 0.002 |
| 17014 | 0.002 |
| 17015 | 0.001 |
| 17016 | 0.006 |
| 17017 | 0.001 |
| 17018 | 0.004 |
| 17019 | 0.005 |
| 17020 | 0.008 |
| 17021 | 0.004 |
| 17022 | 0.003 |
| 17023 | 0.006 |
| 17024 | 0.007 |
| 17025 | 0.005 |
| 17026 | 0.005 |
| 17027 | 0.005 |
| 17028 | 0.004 |
| 17029 | 0.001 |
| 17030 | 0.002 |
| 17031 | 0.008 |
| 17032 | 0.009 |
| 17033 | 0.003 |
| 17034 | 0.009 |
| 17035 | 0.009 |
| 17036 | 0.002 |
| 17037 | 0.008 |
| 17038 | 0.009 |
| 17039 | 0.005 |
| 17040 | 0.004 |
| 17041 | 0.003 |
| 17042 | 0.007 |
| 17043 | 0.006 |
| 17044 | 0.007 |
| 17045 | 0.004 |
| 17046 | 0.004 |
| 17047 | 0.006 |
| 17048 | 0.005 |
| 17049 | 0.003 |
| 17050 | 0.004 |
| 17051 | 0.004 |
| 17052 | 0.003 |
| 17053 | 0.002 |
| 17054 | 0.004 |
| 17055 | 0.003 |
| 17056 | 0.004 |
| 17057 | 0.001 |
| 17058 | 0.001 |
| 17059 | 0.007 |
| 17060 | 0.006 |
| 17061 | 0.004 |
| 17062 | 0.002 |
| 17063 | 0.006 |
| 17064 | 0.008 |
| 17065 | 0.002 |
| 17066 | 0.002 |
| 17067 | 0.003 |
| 17068 | 0.007 |
| 17069 | 0.004 |
| 17070 | 0.004 |
| 17071 | 0.003 |
| 17072 | 0.007 |
| 17073 | 0 |
| 17074 | 0.005 |
| 17075 | 0.004 |
| 17076 | 0.005 |
| 17077 | 0.005 |
| 17078 | 0.005 |
| 17079 | 0.003 |
| 17080 | 0.003 |
| 17081 | 0.003 |
| 17082 | 0.001 |
| 17083 | 0.002 |
| 17084 | 0.005 |
| 17085 | 0.002 |
| 17086 | 0.002 |
| 17087 | 0.001 |
| 17088 | 0.004 |
| 17089 | 0.006 |
| 17090 | 0.003 |
| 17091 | 0.01 |
| 17092 | 0.01 |
| 17093 | 0.005 |
| 17094 | 0.003 |
| 17095 | 0.005 |
| 17096 | 0.007 |
| 17097 | 0 |
| 17098 | 0.002 |
| 17099 | 0.002 |
| 17100 | 0.006 |
| 17101 | 0.002 |
| 17102 | 0.004 |
| 17103 | 0.005 |
| 17104 | 0.002 |
| 17105 | 0.004 |
| 17106 | 0.003 |
| 17107 | 0.002 |
| 17108 | 0.007 |
| 17109 | 0.009 |
| 17110 | 0.002 |
| 17111 | 0.002 |
| 17112 | 0.003 |
| 17113 | 0.002 |
| 17114 | 0.004 |
| 17115 | 0.003 |
| 17116 | 0.002 |
| 17117 | 0.004 |
| 17118 | 0.002 |
| 17119 | 0.003 |
| 17120 | 0.006 |
| 17121 | 0.003 |
| 17122 | 0.004 |
| 17123 | 0.004 |
| 17124 | 0.008 |
| 17125 | 0.012 |
| 17126 | 0.003 |
| 17127 | 0.004 |
| 17128 | 0.004 |
| 17129 | 0.003 |
| 17130 | 0.005 |
| 17131 | 0.005 |
| 17132 | 0.005 |
| 17133 | 0.004 |
| 17134 | 0.003 |
| 17135 | 0.006 |
| 17136 | 0.006 |
| 17137 | 0.001 |
| 17138 | 0.002 |
| 17139 | 0.005 |
| 17140 | 0.004 |
| 17141 | 0.007 |
| 17142 | 0.006 |
| 17143 | 0.008 |
| 17144 | 0.005 |
| 17145 | 0.003 |
| 17146 | 0.004 |
| 17147 | 0.003 |
| 17148 | 0.01 |
| 17149 | 0.012 |
| 17150 | 0.006 |
| 17151 | 0.004 |
| 17152 | 0.003 |
| 17153 | 0.004 |
| 17154 | 0.001 |
| 17155 | 0.004 |
| 17156 | 0.003 |
| 17157 | 0.006 |
| 17158 | 0.007 |
| 17159 | 0.003 |
| 17160 | 0.004 |
| 17161 | 0.007 |
| 17162 | 0.004 |
| 17163 | 0.004 |
| 17164 | 0.006 |
| 17165 | 0.005 |
| 17166 | 0.003 |
| 17167 | 0.009 |
| 17168 | 0.004 |
| 17169 | 0.003 |
| 17170 | 0.003 |
| 17171 | 0.006 |
| 17172 | 0.005 |
| 17173 | 0.002 |
| 17174 | 0.003 |
| 17175 | 0.009 |
| 17176 | 0.008 |
| 17177 | 0.008 |
| 17178 | 0.002 |
| 17179 | 0.004 |
| 17180 | 0.004 |
| 17181 | 0.004 |
| 17182 | 0.002 |
| 17183 | 0.002 |
| 17184 | 0.002 |
| 17185 | 0.003 |
| 17186 | 0.004 |
| 17187 | 0.007 |
| 17188 | 0.011 |
| 17189 | 0.007 |
| 17190 | 0.004 |
| 17191 | 0.009 |
| 17192 | 0.005 |
| 17193 | 0.004 |
| 17194 | 0.003 |
| 17195 | 0.005 |
| 17196 | 0.003 |
| 17197 | 0.007 |
| 17198 | 0.003 |
| 17199 | 0.003 |
| 17200 | 0.005 |
| 17201 | 0 |
| 17202 | 0.002 |
| 17203 | 0.004 |
| 17204 | 0.006 |
| 17205 | 0.009 |
| 17206 | 0.001 |
| 17207 | 0.003 |
| 17208 | 0.005 |
| 17209 | 0.003 |
| 17210 | 0.001 |
| 17211 | 0.003 |
| 17212 | 0.003 |
| 17213 | 0.005 |
| 17214 | 0.004 |
| 17215 | 0.008 |
| 17216 | 0.004 |
| 17217 | 0.001 |
| 17218 | 0.001 |
| 17219 | 0.002 |
| 17220 | 0.005 |
| 17221 | 0.003 |
| 17222 | 0.001 |
| 17223 | 0.002 |
| 17224 | 0.006 |
| 17225 | 0.005 |
| 17226 | 0.001 |
| 17227 | 0.002 |
| 17228 | 0.006 |
| 17229 | 0.009 |
| 17230 | 0.004 |
| 17231 | 0.004 |
| 17232 | 0.013 |
| 17233 | 0.009 |
| 17234 | 0.005 |
| 17235 | 0.006 |
| 17236 | 0.003 |
| 17237 | 0.001 |
| 17238 | 0.004 |
| 17239 | 0.004 |
| 17240 | 0.005 |
| 17241 | 0.006 |
| 17242 | 0.002 |
| 17243 | 0.003 |
| 17244 | 0.005 |
| 17245 | 0.007 |
| 17246 | 0.001 |
| 17247 | 0.005 |
| 17248 | 0.004 |
| 17249 | 0.004 |
| 17250 | 0.001 |
| 17251 | 0.003 |
| 17252 | 0.009 |
| 17253 | 0.009 |
| 17254 | 0.005 |
| 17255 | 0.002 |
| 17256 | 0.005 |
| 17257 | 0.005 |
| 17258 | 0.003 |
| 17259 | 0.004 |
| 17260 | 0.004 |
| 17261 | 0.005 |
| 17262 | 0.004 |
| 17263 | 0.003 |
| 17264 | 0.003 |
| 17265 | 0.006 |
| 17266 | 0.001 |
| 17267 | 0.006 |
| 17268 | 0.008 |
| 17269 | 0.001 |
| 17270 | 0.002 |
| 17271 | 0.002 |
| 17272 | 0.004 |
| 17273 | 0.003 |
| 17274 | 0.001 |
| 17275 | 0.002 |
| 17276 | 0.002 |
| 17277 | 0.004 |
| 17278 | 0.002 |
| 17279 | 0.003 |
| 17280 | 0.003 |
| 17281 | 0.008 |
| 17282 | 0.003 |
| 17283 | 0.003 |
| 17284 | 0.002 |
| 17285 | 0.009 |
| 17286 | 0.001 |
| 17287 | 0.002 |
| 17288 | 0.009 |
| 17289 | 0.004 |
| 17290 | 0.004 |
| 17291 | 0.003 |
| 17292 | 0.003 |
| 17293 | 0.014 |
| 17294 | 0.008 |
| 17295 | 0.002 |
| 17296 | 0.003 |
| 17297 | 0.006 |
| 17298 | 0.001 |
| 17299 | 0.003 |
| 17300 | 0.006 |
| 17301 | 0.008 |
| 17302 | 0.003 |
| 17303 | 0.003 |
| 17304 | 0.002 |
| 17305 | 0.004 |
| 17306 | 0.001 |
| 17307 | 0.003 |
| 17308 | 0.007 |
| 17309 | 0.004 |
| 17310 | 0.001 |
| 17311 | 0.001 |
| 17312 | 0.002 |
| 17313 | 0.005 |
| 17314 | 0.001 |
| 17315 | 0.003 |
| 17316 | 0.003 |
| 17317 | 0.008 |
| 17318 | 0.002 |
| 17319 | 0.002 |
| 17320 | 0.003 |
| 17321 | 0.005 |
| 17322 | 0.006 |
| 17323 | 0.002 |
| 17324 | 0.005 |
| 17325 | 0.005 |
| 17326 | 0.003 |
| 17327 | 0.002 |
| 17328 | 0.004 |
| 17329 | 0.005 |
| 17330 | 0.002 |
| 17331 | 0.002 |
| 17332 | 0.004 |
| 17333 | 0.002 |
| 17334 | 0.003 |
| 17335 | 0.002 |
| 17336 | 0.003 |
| 17337 | 0.003 |
| 17338 | 0.004 |
| 17339 | 0.004 |
| 17340 | 0.003 |
| 17341 | 0.004 |
| 17342 | 0.005 |
| 17343 | 0.003 |
| 17344 | 0.007 |
| 17345 | 0.001 |
| 17346 | 0.003 |
| 17347 | 0.001 |
| 17348 | 0.007 |
| 17349 | 0.007 |
| 17350 | 0.002 |
| 17351 | 0.005 |
| 17352 | 0.006 |
| 17353 | 0.004 |
| 17354 | 0.002 |
| 17355 | 0.002 |
| 17356 | 0.004 |
| 17357 | 0.01 |
| 17358 | 0.002 |
| 17359 | 0.002 |
| 17360 | 0.006 |
| 17361 | 0.006 |
| 17362 | 0.002 |
| 17363 | 0.002 |
| 17364 | 0.003 |
| 17365 | 0.004 |
| 17366 | 0.003 |
| 17367 | 0.005 |
| 17368 | 0.007 |
| 17369 | 0.006 |
| 17370 | 0.002 |
| 17371 | 0.002 |
| 17372 | 0.002 |
| 17373 | 0.004 |
| 17374 | 0.007 |
| 17375 | 0.005 |
| 17376 | 0.008 |
| 17377 | 0.002 |
| 17378 | 0.006 |
| 17379 | 0.001 |
| 17380 | 0.003 |
| 17381 | 0.003 |
| 17382 | 0.002 |
| 17383 | 0.002 |
| 17384 | 0.008 |
| 17385 | 0.005 |
| 17386 | 0.001 |
| 17387 | 0.003 |
| 17388 | 0.007 |
| 17389 | 0.008 |
| 17390 | 0.001 |
| 17391 | 0.003 |
| 17392 | 0.003 |
| 17393 | 0.003 |
| 17394 | 0.004 |
| 17395 | 0.001 |
| 17396 | 0.002 |
| 17397 | 0.003 |
| 17398 | 0.009 |
| 17399 | 0.003 |
| 17400 | 0.002 |
| 17401 | 0.002 |
| 17402 | 0.004 |
| 17403 | 0.004 |
| 17404 | 0.009 |
| 17405 | 0.005 |
| 17406 | 0.004 |
| 17407 | 0.003 |
| 17408 | 0.005 |
| 17409 | 0.006 |
| 17410 | 0.002 |
| 17411 | 0.003 |
| 17412 | 0.002 |
| 17413 | 0.009 |
| 17414 | 0.005 |
| 17415 | 0.002 |
| 17416 | 0.004 |
| 17417 | 0.005 |
| 17418 | 0.002 |
| 17419 | 0.001 |
| 17420 | 0.002 |
| 17421 | 0.002 |
| 17422 | 0.002 |
| 17423 | 0.001 |
| 17424 | 0.005 |
| 17425 | 0.001 |
| 17426 | 0.004 |
| 17427 | 0.007 |
| 17428 | 0.001 |
| 17429 | 0.001 |
| 17430 | 0.005 |
| 17431 | 0.011 |
| 17432 | 0.002 |
| 17433 | 0.006 |
| 17434 | 0.002 |
| 17435 | 0.01 |
| 17436 | 0.007 |
| 17437 | 0.006 |
| 17438 | 0.007 |
| 17439 | 0.003 |
| 17440 | 0.006 |
| 17441 | 0.004 |
| 17442 | 0.01 |
| 17443 | 0.004 |
| 17444 | 0.004 |
| 17445 | 0.006 |
| 17446 | 0.007 |
| 17447 | 0.006 |
| 17448 | 0.001 |
| 17449 | 0.003 |
| 17450 | 0.005 |
| 17451 | 0.002 |
| 17452 | 0.005 |
| 17453 | 0.006 |
| 17454 | 0.004 |
| 17455 | 0.002 |
| 17456 | 0.007 |
| 17457 | 0.003 |
| 17458 | 0.004 |
| 17459 | 0.008 |
| 17460 | 0.006 |
| 17461 | 0.007 |
| 17462 | 0.002 |
| 17463 | 0.009 |
| 17464 | 0.005 |
| 17465 | 0.007 |
| 17466 | 0.003 |
| 17467 | 0.002 |
| 17468 | 0.001 |
| 17469 | 0.004 |
| 17470 | 0.005 |
| 17471 | 0.004 |
| 17472 | 0.013 |
| 17473 | 0.006 |
| 17474 | 0.002 |
| 17475 | 0.005 |
| 17476 | 0.005 |
| 17477 | 0.005 |
| 17478 | 0.003 |
| 17479 | 0.008 |
| 17480 | 0.002 |
| 17481 | 0.005 |
| 17482 | 0.003 |
| 17483 | 0.004 |
| 17484 | 0.003 |
| 17485 | 0.001 |
| 17486 | 0.002 |
| 17487 | 0.003 |
| 17488 | 0.006 |
| 17489 | 0.008 |
| 17490 | 0.004 |
| 17491 | 0.006 |
| 17492 | 0.004 |
| 17493 | 0.001 |
| 17494 | 0.005 |
| 17495 | 0.003 |
| 17496 | 0.004 |
| 17497 | 0.002 |
| 17498 | 0.005 |
| 17499 | 0.005 |
| 17500 | 0.003 |
| 17501 | 0.004 |
| 17502 | 0.002 |
| 17503 | 0.004 |
| 17504 | 0.006 |
| 17505 | 0.003 |
| 17506 | 0.003 |
| 17507 | 0.004 |
| 17508 | 0.003 |
| 17509 | 0.003 |
| 17510 | 0.006 |
| 17511 | 0.006 |
| 17512 | 0.005 |
| 17513 | 0.003 |
| 17514 | 0.004 |
| 17515 | 0.004 |
| 17516 | 0.005 |
| 17517 | 0.006 |
| 17518 | 0.003 |
| 17519 | 0.005 |
| 17520 | 0.006 |
| 17521 | 0.001 |
| 17522 | 0.003 |
| 17523 | 0.006 |
| 17524 | 0.008 |
| 17525 | 0.003 |
| 17526 | 0.004 |
| 17527 | 0.005 |
| 17528 | 0.007 |
| 17529 | 0.006 |
| 17530 | 0.001 |
| 17531 | 0.002 |
| 17532 | 0.002 |
| 17533 | 0.003 |
| 17534 | 0.002 |
| 17535 | 0.002 |
| 17536 | 0.005 |
| 17537 | 0.002 |
| 17538 | 0.003 |
| 17539 | 0.003 |
| 17540 | 0.009 |
| 17541 | 0.003 |
| 17542 | 0.003 |
| 17543 | 0.007 |
| 17544 | 0.002 |
| 17545 | 0.001 |
| 17546 | 0.007 |
| 17547 | 0.009 |
| 17548 | 0.004 |
| 17549 | 0.002 |
| 17550 | 0.002 |
| 17551 | 0.004 |
| 17552 | 0.004 |
| 17553 | 0.003 |
| 17554 | 0.004 |
| 17555 | 0.006 |
| 17556 | 0.004 |
| 17557 | 0.002 |
| 17558 | 0.001 |
| 17559 | 0.008 |
| 17560 | 0.003 |
| 17561 | 0.003 |
| 17562 | 0.003 |
| 17563 | 0.004 |
| 17564 | 0.012 |
| 17565 | 0.003 |
| 17566 | 0.003 |
| 17567 | 0.006 |
| 17568 | 0.003 |
| 17569 | 0.002 |
| 17570 | 0.004 |
| 17571 | 0.004 |
| 17572 | 0.009 |
| 17573 | 0.005 |
| 17574 | 0.007 |
| 17575 | 0.009 |
| 17576 | 0.007 |
| 17577 | 0.001 |
| 17578 | 0.005 |
| 17579 | 0.004 |
| 17580 | 0.005 |
| 17581 | 0.002 |
| 17582 | 0.001 |
| 17583 | 0.003 |
| 17584 | 0.007 |
| 17585 | 0.005 |
| 17586 | 0.002 |
| 17587 | 0.002 |
| 17588 | 0.003 |
| 17589 | 0.006 |
| 17590 | 0.003 |
| 17591 | 0.003 |
| 17592 | 0.008 |
| 17593 | 0.008 |
| 17594 | 0.003 |
| 17595 | 0.005 |
| 17596 | 0.002 |
| 17597 | 0.003 |
| 17598 | 0.003 |
| 17599 | 0.003 |
| 17600 | 0.009 |
| 17601 | 0.006 |
| 17602 | 0 |
| 17603 | 0.002 |
| 17604 | 0.005 |
| 17605 | 0.002 |
| 17606 | 0.002 |
| 17607 | 0.002 |
| 17608 | 0.006 |
| 17609 | 0.002 |
| 17610 | 0.003 |
| 17611 | 0.002 |
| 17612 | 0.005 |
| 17613 | 0.002 |
| 17614 | 0.004 |
| 17615 | 0.003 |
| 17616 | 0.005 |
| 17617 | 0.002 |
| 17618 | 0.002 |
| 17619 | 0.005 |
| 17620 | 0.004 |
| 17621 | 0.001 |
| 17622 | 0.003 |
| 17623 | 0.009 |
| 17624 | 0.013 |
| 17625 | 0.003 |
| 17626 | 0.006 |
| 17627 | 0.008 |
| 17628 | 0.005 |
| 17629 | 0.001 |
| 17630 | 0.005 |
| 17631 | 0.007 |
| 17632 | 0.002 |
| 17633 | 0.005 |
| 17634 | 0.006 |
| 17635 | 0.005 |
| 17636 | 0.009 |
| 17637 | 0.001 |
| 17638 | 0.002 |
| 17639 | 0.004 |
| 17640 | 0.002 |
| 17641 | 0.003 |
| 17642 | 0.004 |
| 17643 | 0.005 |
| 17644 | 0.011 |
| 17645 | 0.001 |
| 17646 | 0.003 |
| 17647 | 0.004 |
| 17648 | 0.004 |
| 17649 | 0.002 |
| 17650 | 0.006 |
| 17651 | 0.006 |
| 17652 | 0.005 |
| 17653 | 0.003 |
| 17654 | 0.003 |
| 17655 | 0.003 |
| 17656 | 0.003 |
| 17657 | 0.002 |
| 17658 | 0.001 |
| 17659 | 0.005 |
| 17660 | 0.007 |
| 17661 | 0.011 |
| 17662 | 0.002 |
| 17663 | 0.005 |
| 17664 | 0.009 |
| 17665 | 0.002 |
| 17666 | 0.002 |
| 17667 | 0.007 |
| 17668 | 0.008 |
| 17669 | 0.002 |
| 17670 | 0.004 |
| 17671 | 0.004 |
| 17672 | 0.004 |
| 17673 | 0.003 |
| 17674 | 0.002 |
| 17675 | 0.002 |
| 17676 | 0.007 |
| 17677 | 0.002 |
| 17678 | 0.009 |
| 17679 | 0.011 |
| 17680 | 0.01 |
| 17681 | 0.003 |
| 17682 | 0.004 |
| 17683 | 0.009 |
| 17684 | 0.006 |
| 17685 | 0.004 |
| 17686 | 0.002 |
| 17687 | 0.004 |
| 17688 | 0.002 |
| 17689 | 0.005 |
| 17690 | 0.005 |
| 17691 | 0.005 |
| 17692 | 0.003 |
| 17693 | 0.002 |
| 17694 | 0.004 |
| 17695 | 0.005 |
| 17696 | 0.005 |
| 17697 | 0.007 |
| 17698 | 0.001 |
| 17699 | 0.003 |
| 17700 | 0.001 |
| 17701 | 0.004 |
| 17702 | 0.003 |
| 17703 | 0.004 |
| 17704 | 0.007 |
| 17705 | 0.006 |
| 17706 | 0.002 |
| 17707 | 0.003 |
| 17708 | 0.008 |
| 17709 | 0.011 |
| 17710 | 0.001 |
| 17711 | 0.002 |
| 17712 | 0.004 |
| 17713 | 0.006 |
| 17714 | 0.003 |
| 17715 | 0.002 |
| 17716 | 0.002 |
| 17717 | 0.004 |
| 17718 | 0.001 |
| 17719 | 0.006 |
| 17720 | 0.003 |
| 17721 | 0.004 |
| 17722 | 0.008 |
| 17723 | 0.006 |
| 17724 | 0.006 |
| 17725 | 0.003 |
| 17726 | 0.006 |
| 17727 | 0.005 |
| 17728 | 0.005 |
| 17729 | 0.006 |
| 17730 | 0.004 |
| 17731 | 0.01 |
| 17732 | 0.01 |
| 17733 | 0.009 |
| 17734 | 0.009 |
| 17735 | 0.007 |
| 17736 | 0.002 |
| 17737 | 0.003 |
| 17738 | 0.002 |
| 17739 | 0.004 |
| 17740 | 0.005 |
| 17741 | 0.002 |
| 17742 | 0.003 |
| 17743 | 0.003 |
| 17744 | 0.005 |
| 17745 | 0.004 |
| 17746 | 0.01 |
| 17747 | 0.006 |
| 17748 | 0.004 |
| 17749 | 0.004 |
| 17750 | 0.003 |
| 17751 | 0.007 |
| 17752 | 0.002 |
| 17753 | 0.005 |
| 17754 | 0.004 |
| 17755 | 0.003 |
| 17756 | 0.006 |
| 17757 | 0.004 |
| 17758 | 0.007 |
| 17759 | 0.003 |
| 17760 | 0.003 |
| 17761 | 0.008 |
| 17762 | 0.005 |
| 17763 | 0.011 |
| 17764 | 0.004 |
| 17765 | 0.006 |
| 17766 | 0.011 |
| 17767 | 0.004 |
| 17768 | 0.002 |
| 17769 | 0.004 |
| 17770 | 0.005 |
| 17771 | 0.005 |
| 17772 | 0.005 |
| 17773 | 0.009 |
| 17774 | 0.005 |
| 17775 | 0.003 |
| 17776 | 0.005 |
| 17777 | 0.006 |
| 17778 | 0.008 |
| 17779 | 0.006 |
| 17780 | 0.008 |
| 17781 | 0.009 |
| 17782 | 0.004 |
| 17783 | 0.006 |
| 17784 | 0.003 |
| 17785 | 0.006 |
| 17786 | 0.006 |
| 17787 | 0.003 |
| 17788 | 0.003 |
| 17789 | 0.003 |
| 17790 | 0.004 |
| 17791 | 0.002 |
| 17792 | 0.005 |
| 17793 | 0.002 |
| 17794 | 0.005 |
| 17795 | 0.004 |
| 17796 | 0.003 |
| 17797 | 0.001 |
| 17798 | 0.005 |
| 17799 | 0.004 |
| 17800 | 0.001 |
| 17801 | 0.006 |
| 17802 | 0.002 |
| 17803 | 0.003 |
| 17804 | 0.004 |
| 17805 | 0.004 |
| 17806 | 0.001 |
| 17807 | 0.002 |
| 17808 | 0.004 |
| 17809 | 0.003 |
| 17810 | 0.002 |
| 17811 | 0.011 |
| 17812 | 0.013 |
| 17813 | 0.014 |
| 17814 | 0.005 |
| 17815 | 0.007 |
| 17816 | 0.01 |
| 17817 | 0.006 |
| 17818 | 0.003 |
| 17819 | 0.004 |
| 17820 | 0.012 |
| 17821 | 0.005 |
| 17822 | 0.004 |
| 17823 | 0.004 |
| 17824 | 0.004 |
| 17825 | 0.005 |
| 17826 | 0.002 |
| 17827 | 0.002 |
| 17828 | 0.004 |
| 17829 | 0.004 |
| 17830 | 0.004 |
| 17831 | 0.002 |
| 17832 | 0.008 |
| 17833 | 0.002 |
| 17834 | 0.004 |
| 17835 | 0.004 |
| 17836 | 0.005 |
| 17837 | 0.007 |
| 17838 | 0.003 |
| 17839 | 0.003 |
| 17840 | 0.004 |
| 17841 | 0.005 |
| 17842 | 0.007 |
| 17843 | 0.005 |
| 17844 | 0.003 |
| 17845 | 0.012 |
| 17846 | 0.006 |
| 17847 | 0.002 |
| 17848 | 0.006 |
| 17849 | 0.005 |
| 17850 | 0.003 |
| 17851 | 0.001 |
| 17852 | 0.004 |
| 17853 | 0.003 |
| 17854 | 0.001 |
| 17855 | 0.004 |
| 17856 | 0.014 |
| 17857 | 0.006 |
| 17858 | 0.003 |
| 17859 | 0.004 |
| 17860 | 0.002 |
| 17861 | 0.007 |
| 17862 | 0.002 |
| 17863 | 0.001 |
| 17864 | 0.003 |
| 17865 | 0.005 |
| 17866 | 0.003 |
| 17867 | 0.004 |
| 17868 | 0.002 |
| 17869 | 0.002 |
| 17870 | 0.004 |
| 17871 | 0.003 |
| 17872 | 0.005 |
| 17873 | 0.006 |
| 17874 | 0.004 |
| 17875 | 0.003 |
| 17876 | 0.005 |
| 17877 | 0.006 |
| 17878 | 0.003 |
| 17879 | 0.003 |
| 17880 | 0.006 |
| 17881 | 0.005 |
| 17882 | 0.003 |
| 17883 | 0.004 |
| 17884 | 0.007 |
| 17885 | 0.005 |
| 17886 | 0.003 |
| 17887 | 0.003 |
| 17888 | 0.006 |
| 17889 | 0.002 |
| 17890 | 0.002 |
| 17891 | 0.007 |
| 17892 | 0.006 |
| 17893 | 0.005 |
| 17894 | 0.004 |
| 17895 | 0.009 |
| 17896 | 0.006 |
| 17897 | 0.004 |
| 17898 | 0.003 |
| 17899 | 0.004 |
| 17900 | 0.003 |
| 17901 | 0.005 |
| 17902 | 0.002 |
| 17903 | 0.001 |
| 17904 | 0.005 |
| 17905 | 0.003 |
| 17906 | 0.003 |
| 17907 | 0.004 |
| 17908 | 0.005 |
| 17909 | 0.003 |
| 17910 | 0.001 |
| 17911 | 0.002 |
| 17912 | 0.001 |
| 17913 | 0.009 |
| 17914 | 0.001 |
| 17915 | 0.001 |
| 17916 | 0.008 |
| 17917 | 0.008 |
| 17918 | 0.004 |
| 17919 | 0.003 |
| 17920 | 0.002 |
| 17921 | 0.005 |
| 17922 | 0.002 |
| 17923 | 0.004 |
| 17924 | 0.006 |
| 17925 | 0.005 |
| 17926 | 0.002 |
| 17927 | 0.002 |
| 17928 | 0.004 |
| 17929 | 0.004 |
| 17930 | 0.004 |
| 17931 | 0.004 |
| 17932 | 0.007 |
| 17933 | 0.006 |
| 17934 | 0.004 |
| 17935 | 0.003 |
| 17936 | 0.004 |
| 17937 | 0.003 |
| 17938 | 0.003 |
| 17939 | 0.003 |
| 17940 | 0.006 |
| 17941 | 0.002 |
| 17942 | 0.001 |
| 17943 | 0.003 |
| 17944 | 0.006 |
| 17945 | 0.007 |
| 17946 | 0.005 |
| 17947 | 0.002 |
| 17948 | 0.003 |
| 17949 | 0.003 |
| 17950 | 0.002 |
| 17951 | 0.004 |
| 17952 | 0.006 |
| 17953 | 0.004 |
| 17954 | 0.004 |
| 17955 | 0.002 |
| 17956 | 0.002 |
| 17957 | 0.006 |
| 17958 | 0.001 |
| 17959 | 0.002 |
| 17960 | 0.005 |
| 17961 | 0.002 |
| 17962 | 0.002 |
| 17963 | 0.003 |
| 17964 | 0.005 |
| 17965 | 0.005 |
| 17966 | 0.002 |
| 17967 | 0.003 |
| 17968 | 0.006 |
| 17969 | 0.009 |
| 17970 | 0.004 |
| 17971 | 0.003 |
| 17972 | 0.003 |
| 17973 | 0.01 |
| 17974 | 0.003 |
| 17975 | 0.004 |
| 17976 | 0.004 |
| 17977 | 0.004 |
| 17978 | 0.002 |
| 17979 | 0.003 |
| 17980 | 0.004 |
| 17981 | 0.004 |
| 17982 | 0.001 |
| 17983 | 0.002 |
| 17984 | 0.004 |
| 17985 | 0.009 |
| 17986 | 0.004 |
| 17987 | 0.004 |
| 17988 | 0.002 |
| 17989 | 0.004 |
| 17990 | 0.002 |
| 17991 | 0.004 |
| 17992 | 0.004 |
| 17993 | 0.001 |
| 17994 | 0.008 |
| 17995 | 0.004 |
| 17996 | 0.003 |
| 17997 | 0.008 |
| 17998 | 0.003 |
| 17999 | 0.005 |
| 18000 | 0.004 |
| 18001 | 0.003 |
| 18002 | 0.002 |
| 18003 | 0.004 |
| 18004 | 0.009 |
| 18005 | 0.003 |
| 18006 | 0.003 |
| 18007 | 0.004 |
| 18008 | 0.001 |
| 18009 | 0.007 |
| 18010 | 0.002 |
| 18011 | 0.004 |
| 18012 | 0.004 |
| 18013 | 0.007 |
| 18014 | 0.001 |
| 18015 | 0.001 |
| 18016 | 0.007 |
| 18017 | 0.003 |
| 18018 | 0.003 |
| 18019 | 0.005 |
| 18020 | 0.009 |
| 18021 | 0.001 |
| 18022 | 0.003 |
| 18023 | 0.003 |
| 18024 | 0.008 |
| 18025 | 0.004 |
| 18026 | 0.002 |
| 18027 | 0.004 |
| 18028 | 0.011 |
| 18029 | 0.007 |
| 18030 | 0.003 |
| 18031 | 0.004 |
| 18032 | 0.003 |
| 18033 | 0.011 |
| 18034 | 0.01 |
| 18035 | 0.004 |
| 18036 | 0.004 |
| 18037 | 0.002 |
| 18038 | 0.005 |
| 18039 | 0.007 |
| 18040 | 0.005 |
| 18041 | 0.003 |
| 18042 | 0.002 |
| 18043 | 0.005 |
| 18044 | 0.006 |
| 18045 | 0.005 |
| 18046 | 0.006 |
| 18047 | 0.006 |
| 18048 | 0.007 |
| 18049 | 0.003 |
| 18050 | 0.003 |
| 18051 | 0.002 |
| 18052 | 0.01 |
| 18053 | 0.014 |
| 18054 | 0.003 |
| 18055 | 0.003 |
| 18056 | 0.003 |
| 18057 | 0.002 |
| 18058 | 0.001 |
| 18059 | 0.003 |
| 18060 | 0.004 |
| 18061 | 0.005 |
| 18062 | 0.005 |
| 18063 | 0.005 |
| 18064 | 0.002 |
| 18065 | 0.006 |
| 18066 | 0.001 |
| 18067 | 0.004 |
| 18068 | 0.002 |
| 18069 | 0.009 |
| 18070 | 0.002 |
| 18071 | 0.007 |
| 18072 | 0.008 |
| 18073 | 0.003 |
| 18074 | 0.001 |
| 18075 | 0.007 |
| 18076 | 0.008 |
| 18077 | 0.007 |
| 18078 | 0 |
| 18079 | 0.003 |
| 18080 | 0.001 |
| 18081 | 0.004 |
| 18082 | 0.003 |
| 18083 | 0.002 |
| 18084 | 0.004 |
| 18085 | 0.003 |
| 18086 | 0.003 |
| 18087 | 0.006 |
| 18088 | 0.003 |
| 18089 | 0.004 |
| 18090 | 0.006 |
| 18091 | 0.005 |
| 18092 | 0.008 |
| 18093 | 0.001 |
| 18094 | 0.002 |
| 18095 | 0.013 |
| 18096 | 0.008 |
| 18097 | 0.002 |
| 18098 | 0.003 |
| 18099 | 0.004 |
| 18100 | 0.014 |
| 18101 | 0.002 |
| 18102 | 0.002 |
| 18103 | 0.004 |
| 18104 | 0.004 |
| 18105 | 0.002 |
| 18106 | 0.004 |
| 18107 | 0.001 |
| 18108 | 0.001 |
| 18109 | 0.003 |
| 18110 | 0.001 |
| 18111 | 0.003 |
| 18112 | 0.002 |
| 18113 | 0.006 |
| 18114 | 0.001 |
| 18115 | 0.005 |
| 18116 | 0.004 |
| 18117 | 0.002 |
| 18118 | 0.003 |
| 18119 | 0.011 |
| 18120 | 0.007 |
| 18121 | 0.004 |
| 18122 | 0.005 |
| 18123 | 0.001 |
| 18124 | 0.003 |
| 18125 | 0.004 |
| 18126 | 0.001 |
| 18127 | 0.004 |
| 18128 | 0.004 |
| 18129 | 0.004 |
| 18130 | 0.004 |
| 18131 | 0.001 |
| 18132 | 0.002 |
| 18133 | 0.006 |
| 18134 | 0.002 |
| 18135 | 0.003 |
| 18136 | 0.005 |
| 18137 | 0.007 |
| 18138 | 0.002 |
| 18139 | 0.003 |
| 18140 | 0.005 |
| 18141 | 0.002 |
| 18142 | 0.003 |
| 18143 | 0.004 |
| 18144 | 0.003 |
| 18145 | 0.003 |
| 18146 | 0.007 |
| 18147 | 0.002 |
| 18148 | 0.005 |
| 18149 | 0.002 |
| 18150 | 0.001 |
| 18151 | 0.005 |
| 18152 | 0.004 |
| 18153 | 0.003 |
| 18154 | 0.007 |
| 18155 | 0.006 |
| 18156 | 0.007 |
| 18157 | 0.006 |
| 18158 | 0.006 |
| 18159 | 0.007 |
| 18160 | 0.005 |
| 18161 | 0.003 |
| 18162 | 0.005 |
| 18163 | 0.003 |
| 18164 | 0.006 |
| 18165 | 0.003 |
| 18166 | 0 |
| 18167 | 0.004 |
| 18168 | 0.002 |
| 18169 | 0.003 |
| 18170 | 0.002 |
| 18171 | 0.001 |
| 18172 | 0.004 |
| 18173 | 0.008 |
| 18174 | 0.003 |
| 18175 | 0.005 |
| 18176 | 0.001 |
| 18177 | 0.007 |
| 18178 | 0.003 |
| 18179 | 0.004 |
| 18180 | 0.004 |
| 18181 | 0.003 |
| 18182 | 0.003 |
| 18183 | 0.002 |
| 18184 | 0.002 |
| 18185 | 0.004 |
| 18186 | 0.004 |
| 18187 | 0.006 |
| 18188 | 0.004 |
| 18189 | 0.01 |
| 18190 | 0.002 |
| 18191 | 0.004 |
| 18192 | 0.01 |
| 18193 | 0.004 |
| 18194 | 0.004 |
| 18195 | 0.004 |
| 18196 | 0.006 |
| 18197 | 0.009 |
| 18198 | 0.003 |
| 18199 | 0.003 |
| 18200 | 0.005 |
| 18201 | 0.003 |
| 18202 | 0.001 |
| 18203 | 0.001 |
| 18204 | 0.002 |
| 18205 | 0.005 |
| 18206 | 0.001 |
| 18207 | 0.003 |
| 18208 | 0.001 |
| 18209 | 0.001 |
| 18210 | 0.003 |
| 18211 | 0.001 |
| 18212 | 0.006 |
| 18213 | 0.003 |
| 18214 | 0.002 |
| 18215 | 0.002 |
| 18216 | 0.002 |
| 18217 | 0.009 |
| 18218 | 0.004 |
| 18219 | 0.004 |
| 18220 | 0.004 |
| 18221 | 0.006 |
| 18222 | 0.005 |
| 18223 | 0.002 |
| 18224 | 0.002 |
| 18225 | 0.005 |
| 18226 | 0.004 |
| 18227 | 0.001 |
| 18228 | 0.007 |
| 18229 | 0.01 |
| 18230 | 0.001 |
| 18231 | 0.005 |
| 18232 | 0.004 |
| 18233 | 0.003 |
| 18234 | 0.003 |
| 18235 | 0.004 |
| 18236 | 0.006 |
| 18237 | 0.003 |
| 18238 | 0.007 |
| 18239 | 0.01 |
| 18240 | 0.011 |
| 18241 | 0.002 |
| 18242 | 0.002 |
| 18243 | 0.005 |
| 18244 | 0.006 |
| 18245 | 0.004 |
| 18246 | 0.004 |
| 18247 | 0.001 |
| 18248 | 0.001 |
| 18249 | 0.006 |
| 18250 | 0.002 |
| 18251 | 0.006 |
| 18252 | 0.008 |
| 18253 | 0.006 |
| 18254 | 0.003 |
| 18255 | 0.003 |
| 18256 | 0.003 |
| 18257 | 0.004 |
| 18258 | 0.002 |
| 18259 | 0.001 |
| 18260 | 0.003 |
| 18261 | 0.011 |
| 18262 | 0.002 |
| 18263 | 0.005 |
| 18264 | 0.008 |
| 18265 | 0.001 |
| 18266 | 0.002 |
| 18267 | 0.006 |
| 18268 | 0.004 |
| 18269 | 0.003 |
| 18270 | 0.004 |
| 18271 | 0.006 |
| 18272 | 0.005 |
| 18273 | 0.001 |
| 18274 | 0.003 |
| 18275 | 0.007 |
| 18276 | 0.008 |
| 18277 | 0.004 |
| 18278 | 0.002 |
| 18279 | 0.003 |
| 18280 | 0.004 |
| 18281 | 0.001 |
| 18282 | 0.003 |
| 18283 | 0.001 |
| 18284 | 0.006 |
| 18285 | 0.004 |
| 18286 | 0.008 |
| 18287 | 0.013 |
| 18288 | 0.004 |
| 18289 | 0.001 |
| 18290 | 0.004 |
| 18291 | 0.007 |
| 18292 | 0.005 |
| 18293 | 0.003 |
| 18294 | 0.003 |
| 18295 | 0.002 |
| 18296 | 0.002 |
| 18297 | 0.002 |
| 18298 | 0.004 |
| 18299 | 0.007 |
| 18300 | 0.005 |
| 18301 | 0.002 |
| 18302 | 0.003 |
| 18303 | 0.006 |
| 18304 | 0.005 |
| 18305 | 0.002 |
| 18306 | 0.005 |
| 18307 | 0.002 |
| 18308 | 0.008 |
| 18309 | 0.002 |
| 18310 | 0.002 |
| 18311 | 0.005 |
| 18312 | 0.004 |
| 18313 | 0.001 |
| 18314 | 0.002 |
| 18315 | 0.005 |
| 18316 | 0.004 |
| 18317 | 0.002 |
| 18318 | 0.001 |
| 18319 | 0.011 |
| 18320 | 0.004 |
| 18321 | 0.005 |
| 18322 | 0.004 |
| 18323 | 0.004 |
| 18324 | 0.003 |
| 18325 | 0.005 |
| 18326 | 0.004 |
| 18327 | 0.001 |
| 18328 | 0.003 |
| 18329 | 0.006 |
| 18330 | 0.003 |
| 18331 | 0.003 |
| 18332 | 0.004 |
| 18333 | 0.004 |
| 18334 | 0.002 |
| 18335 | 0.002 |
| 18336 | 0.003 |
| 18337 | 0.002 |
| 18338 | 0.001 |
| 18339 | 0.001 |
| 18340 | 0.009 |
| 18341 | 0.005 |
| 18342 | 0.004 |
| 18343 | 0.003 |
| 18344 | 0.003 |
| 18345 | 0.001 |
| 18346 | 0.004 |
| 18347 | 0.004 |
| 18348 | 0.006 |
| 18349 | 0.009 |
| 18350 | 0.011 |
| 18351 | 0.002 |
| 18352 | 0.002 |
| 18353 | 0.003 |
| 18354 | 0.004 |
| 18355 | 0.003 |
| 18356 | 0.002 |
| 18357 | 0.005 |
| 18358 | 0.003 |
| 18359 | 0.007 |
| 18360 | 0.008 |
| 18361 | 0.003 |
| 18362 | 0.003 |
| 18363 | 0.001 |
| 18364 | 0.004 |
| 18365 | 0.004 |
| 18366 | 0.001 |
| 18367 | 0.003 |
| 18368 | 0.007 |
| 18369 | 0.003 |
| 18370 | 0.005 |
| 18371 | 0.005 |
| 18372 | 0.002 |
| 18373 | 0.004 |
| 18374 | 0.002 |
| 18375 | 0.003 |
| 18376 | 0.005 |
| 18377 | 0.001 |
| 18378 | 0.007 |
| 18379 | 0.002 |
| 18380 | 0.001 |
| 18381 | 0.003 |
| 18382 | 0.002 |
| 18383 | 0.006 |
| 18384 | 0.011 |
| 18385 | 0.015 |
| 18386 | 0.007 |
| 18387 | 0.006 |
| 18388 | 0.003 |
| 18389 | 0.003 |
| 18390 | 0.003 |
| 18391 | 0.003 |
| 18392 | 0.002 |
| 18393 | 0.004 |
| 18394 | 0.005 |
| 18395 | 0.002 |
| 18396 | 0.003 |
| 18397 | 0.003 |
| 18398 | 0.005 |
| 18399 | 0.008 |
| 18400 | 0.006 |
| 18401 | 0.005 |
| 18402 | 0.005 |
| 18403 | 0.006 |
| 18404 | 0.008 |
| 18405 | 0.005 |
| 18406 | 0.01 |
| 18407 | 0.011 |
| 18408 | 0.008 |
| 18409 | 0.006 |
| 18410 | 0.009 |
| 18411 | 0.006 |
| 18412 | 0.003 |
| 18413 | 0.002 |
| 18414 | 0.005 |
| 18415 | 0.003 |
| 18416 | 0.007 |
| 18417 | 0.006 |
| 18418 | 0.007 |
| 18419 | 0.005 |
| 18420 | 0.009 |
| 18421 | 0.012 |
| 18422 | 0.011 |
| 18423 | 0.005 |
| 18424 | 0.006 |
| 18425 | 0.005 |
| 18426 | 0.004 |
| 18427 | 0.004 |
| 18428 | 0.005 |
| 18429 | 0.007 |
| 18430 | 0.008 |
| 18431 | 0.008 |
| 18432 | 0.008 |
| 18433 | 0.004 |
| 18434 | 0.005 |
| 18435 | 0.003 |
| 18436 | 0.007 |
| 18437 | 0.006 |
| 18438 | 0.003 |
| 18439 | 0.008 |
| 18440 | 0.002 |
| 18441 | 0.003 |
| 18442 | 0.003 |
| 18443 | 0.008 |
| 18444 | 0.007 |
| 18445 | 0.004 |
| 18446 | 0.002 |
| 18447 | 0.004 |
| 18448 | 0.004 |
| 18449 | 0.006 |
| 18450 | 0.004 |
| 18451 | 0.005 |
| 18452 | 0.006 |
| 18453 | 0.002 |
| 18454 | 0.005 |
| 18455 | 0.003 |
| 18456 | 0.007 |
| 18457 | 0.003 |
| 18458 | 0.005 |
| 18459 | 0.003 |
| 18460 | 0.002 |
| 18461 | 0.005 |
| 18462 | 0.002 |
| 18463 | 0.001 |
| 18464 | 0.001 |
| 18465 | 0.003 |
| 18466 | 0.005 |
| 18467 | 0.003 |
| 18468 | 0.007 |
| 18469 | 0.01 |
| 18470 | 0.002 |
| 18471 | 0.004 |
| 18472 | 0.007 |
| 18473 | 0.003 |
| 18474 | 0.004 |
| 18475 | 0.003 |
| 18476 | 0.001 |
| 18477 | 0.003 |
| 18478 | 0.003 |
| 18479 | 0.006 |
| 18480 | 0.007 |
| 18481 | 0.006 |
| 18482 | 0.003 |
| 18483 | 0.002 |
| 18484 | 0.004 |
| 18485 | 0.001 |
| 18486 | 0.004 |
| 18487 | 0.004 |
| 18488 | 0.012 |
| 18489 | 0.005 |
| 18490 | 0.003 |
| 18491 | 0.002 |
| 18492 | 0.003 |
| 18493 | 0.002 |
| 18494 | 0.003 |
| 18495 | 0.006 |
| 18496 | 0.007 |
| 18497 | 0.005 |
| 18498 | 0.003 |
| 18499 | 0.004 |
| 18500 | 0.007 |
| 18501 | 0.007 |
| 18502 | 0.003 |
| 18503 | 0.006 |
| 18504 | 0.004 |
| 18505 | 0.005 |
| 18506 | 0.004 |
| 18507 | 0.004 |
| 18508 | 0.005 |
| 18509 | 0.009 |
| 18510 | 0.003 |
| 18511 | 0.003 |
| 18512 | 0.004 |
| 18513 | 0.002 |
| 18514 | 0.001 |
| 18515 | 0.002 |
| 18516 | 0.004 |
| 18517 | 0.008 |
| 18518 | 0.003 |
| 18519 | 0.004 |
| 18520 | 0.004 |
| 18521 | 0.003 |
| 18522 | 0.005 |
| 18523 | 0.005 |
| 18524 | 0.005 |
| 18525 | 0.004 |
| 18526 | 0.003 |
| 18527 | 0.003 |
| 18528 | 0.004 |
| 18529 | 0.008 |
| 18530 | 0.002 |
| 18531 | 0.003 |
| 18532 | 0.005 |
| 18533 | 0.005 |
| 18534 | 0 |
| 18535 | 0.004 |
| 18536 | 0.006 |
| 18537 | 0.002 |
| 18538 | 0.002 |
| 18539 | 0.003 |
| 18540 | 0.002 |
| 18541 | 0.002 |
| 18542 | 0.005 |
| 18543 | 0.006 |
| 18544 | 0.004 |
| 18545 | 0.004 |
| 18546 | 0.002 |
| 18547 | 0.002 |
| 18548 | 0.005 |
| 18549 | 0.004 |
| 18550 | 0.003 |
| 18551 | 0.003 |
| 18552 | 0.002 |
| 18553 | 0.008 |
| 18554 | 0.002 |
| 18555 | 0.006 |
| 18556 | 0.003 |
| 18557 | 0.008 |
| 18558 | 0.004 |
| 18559 | 0.003 |
| 18560 | 0.004 |
| 18561 | 0.006 |
| 18562 | 0.003 |
| 18563 | 0.003 |
| 18564 | 0.009 |
| 18565 | 0.005 |
| 18566 | 0.001 |
| 18567 | 0.002 |
| 18568 | 0.004 |
| 18569 | 0.006 |
| 18570 | 0.001 |
| 18571 | 0.003 |
| 18572 | 0.003 |
| 18573 | 0.004 |
| 18574 | 0.004 |
| 18575 | 0.011 |
| 18576 | 0.005 |
| 18577 | 0.005 |
| 18578 | 0.004 |
| 18579 | 0.006 |
| 18580 | 0.004 |
| 18581 | 0.004 |
| 18582 | 0.008 |
| 18583 | 0.006 |
| 18584 | 0.008 |
| 18585 | 0.007 |
| 18586 | 0.003 |
| 18587 | 0.005 |
| 18588 | 0.008 |
| 18589 | 0.004 |
| 18590 | 0.002 |
| 18591 | 0.004 |
| 18592 | 0.009 |
| 18593 | 0.003 |
| 18594 | 0.003 |
| 18595 | 0.002 |
| 18596 | 0.005 |
| 18597 | 0.008 |
| 18598 | 0.003 |
| 18599 | 0.004 |
| 18600 | 0.004 |
| 18601 | 0.004 |
| 18602 | 0.003 |
| 18603 | 0.004 |
| 18604 | 0.005 |
| 18605 | 0.001 |
| 18606 | 0.002 |
| 18607 | 0.003 |
| 18608 | 0.009 |
| 18609 | 0.005 |
| 18610 | 0.003 |
| 18611 | 0.006 |
| 18612 | 0.003 |
| 18613 | 0.004 |
| 18614 | 0.005 |
| 18615 | 0.007 |
| 18616 | 0.009 |
| 18617 | 0.004 |
| 18618 | 0.001 |
| 18619 | 0.006 |
| 18620 | 0.009 |
| 18621 | 0.003 |
| 18622 | 0.004 |
| 18623 | 0.004 |
| 18624 | 0.005 |
| 18625 | 0.002 |
| 18626 | 0.004 |
| 18627 | 0.006 |
| 18628 | 0.011 |
| 18629 | 0.002 |
| 18630 | 0.003 |
| 18631 | 0.009 |
| 18632 | 0.005 |
| 18633 | 0.003 |
| 18634 | 0.009 |
| 18635 | 0.011 |
| 18636 | 0.006 |
| 18637 | 0.003 |
| 18638 | 0.004 |
| 18639 | 0.009 |
| 18640 | 0.006 |
| 18641 | 0.002 |
| 18642 | 0.004 |
| 18643 | 0.004 |
| 18644 | 0.002 |
| 18645 | 0.004 |
| 18646 | 0.001 |
| 18647 | 0.003 |
| 18648 | 0.007 |
| 18649 | 0.006 |
| 18650 | 0.004 |
| 18651 | 0.004 |
| 18652 | 0.002 |
| 18653 | 0.007 |
| 18654 | 0.001 |
| 18655 | 0.004 |
| 18656 | 0.007 |
| 18657 | 0.002 |
| 18658 | 0.006 |
| 18659 | 0.003 |
| 18660 | 0.001 |
| 18661 | 0.005 |
| 18662 | 0.002 |
| 18663 | 0.001 |
| 18664 | 0.004 |
| 18665 | 0.005 |
| 18666 | 0.005 |
| 18667 | 0.002 |
| 18668 | 0.005 |
| 18669 | 0.003 |
| 18670 | 0.007 |
| 18671 | 0.01 |
| 18672 | 0.002 |
| 18673 | 0.003 |
| 18674 | 0.001 |
| 18675 | 0.005 |
| 18676 | 0.006 |
| 18677 | 0.005 |
| 18678 | 0.007 |
| 18679 | 0.005 |
| 18680 | 0.002 |
| 18681 | 0.002 |
| 18682 | 0.002 |
| 18683 | 0.001 |
| 18684 | 0.009 |
| 18685 | 0.005 |
| 18686 | 0.002 |
| 18687 | 0.005 |
| 18688 | 0.002 |
| 18689 | 0.004 |
| 18690 | 0.007 |
| 18691 | 0.011 |
| 18692 | 0.01 |
| 18693 | 0.004 |
| 18694 | 0.005 |
| 18695 | 0.007 |
| 18696 | 0.006 |
| 18697 | 0.004 |
| 18698 | 0.004 |
| 18699 | 0.003 |
| 18700 | 0.005 |
| 18701 | 0.007 |
| 18702 | 0.009 |
| 18703 | 0.007 |
| 18704 | 0.009 |
| 18705 | 0.007 |
| 18706 | 0.004 |
| 18707 | 0.005 |
| 18708 | 0.005 |
| 18709 | 0.003 |
| 18710 | 0.002 |
| 18711 | 0.013 |
| 18712 | 0.007 |
| 18713 | 0.005 |
| 18714 | 0.005 |
| 18715 | 0.004 |
| 18716 | 0.007 |
| 18717 | 0.004 |
| 18718 | 0.002 |
| 18719 | 0.004 |
| 18720 | 0.005 |
| 18721 | 0.001 |
| 18722 | 0.003 |
| 18723 | 0.009 |
| 18724 | 0 |
| 18725 | 0.001 |
| 18726 | 0.002 |
| 18727 | 0.008 |
| 18728 | 0.007 |
| 18729 | 0.008 |
| 18730 | 0.007 |
| 18731 | 0.005 |
| 18732 | 0.003 |
| 18733 | 0.001 |
| 18734 | 0.002 |
| 18735 | 0.005 |
| 18736 | 0.005 |
| 18737 | 0.006 |
| 18738 | 0.009 |
| 18739 | 0.004 |
| 18740 | 0.002 |
| 18741 | 0.003 |
| 18742 | 0.007 |
| 18743 | 0.008 |
| 18744 | 0.005 |
| 18745 | 0.005 |
| 18746 | 0.005 |
| 18747 | 0.007 |
| 18748 | 0.004 |
| 18749 | 0.004 |
| 18750 | 0.003 |
| 18751 | 0.002 |
| 18752 | 0.001 |
| 18753 | 0.005 |
| 18754 | 0.006 |
| 18755 | 0.004 |
| 18756 | 0.006 |
| 18757 | 0.008 |
| 18758 | 0.002 |
| 18759 | 0.002 |
| 18760 | 0.001 |
| 18761 | 0.002 |
| 18762 | 0.002 |
| 18763 | 0.006 |
| 18764 | 0.01 |
| 18765 | 0.007 |
| 18766 | 0.002 |
| 18767 | 0.004 |
| 18768 | 0.002 |
| 18769 | 0.003 |
| 18770 | 0.002 |
| 18771 | 0.005 |
| 18772 | 0.008 |
| 18773 | 0.005 |
| 18774 | 0.002 |
| 18775 | 0.003 |
| 18776 | 0.007 |
| 18777 | 0.007 |
| 18778 | 0.005 |
| 18779 | 0.002 |
| 18780 | 0.004 |
| 18781 | 0.008 |
| 18782 | 0.004 |
| 18783 | 0.003 |
| 18784 | 0.007 |
| 18785 | 0.005 |
| 18786 | 0.001 |
| 18787 | 0.004 |
| 18788 | 0.005 |
| 18789 | 0.007 |
| 18790 | 0.002 |
| 18791 | 0.005 |
| 18792 | 0.007 |
| 18793 | 0.005 |
| 18794 | 0.003 |
| 18795 | 0.003 |
| 18796 | 0.002 |
| 18797 | 0.005 |
| 18798 | 0.004 |
| 18799 | 0.01 |
| 18800 | 0.005 |
| 18801 | 0.003 |
| 18802 | 0.002 |
| 18803 | 0.004 |
| 18804 | 0.006 |
| 18805 | 0.003 |
| 18806 | 0.003 |
| 18807 | 0.003 |
| 18808 | 0.002 |
| 18809 | 0.005 |
| 18810 | 0.003 |
| 18811 | 0.002 |
| 18812 | 0.007 |
| 18813 | 0.003 |
| 18814 | 0.006 |
| 18815 | 0.008 |
| 18816 | 0.006 |
| 18817 | 0.002 |
| 18818 | 0.001 |
| 18819 | 0.006 |
| 18820 | 0.004 |
| 18821 | 0.002 |
| 18822 | 0.002 |
| 18823 | 0.002 |
| 18824 | 0.004 |
| 18825 | 0.002 |
| 18826 | 0.003 |
| 18827 | 0.002 |
| 18828 | 0.004 |
| 18829 | 0.003 |
| 18830 | 0.01 |
| 18831 | 0.006 |
| 18832 | 0.003 |
| 18833 | 0.002 |
| 18834 | 0.004 |
| 18835 | 0.008 |
| 18836 | 0.004 |
| 18837 | 0.003 |
| 18838 | 0.004 |
| 18839 | 0.004 |
| 18840 | 0.004 |
| 18841 | 0.003 |
| 18842 | 0.004 |
| 18843 | 0.005 |
| 18844 | 0.007 |
| 18845 | 0.003 |
| 18846 | 0.001 |
| 18847 | 0.005 |
| 18848 | 0.001 |
| 18849 | 0.001 |
| 18850 | 0.003 |
| 18851 | 0.003 |
| 18852 | 0.01 |
| 18853 | 0.002 |
| 18854 | 0.003 |
| 18855 | 0.004 |
| 18856 | 0.006 |
| 18857 | 0.008 |
| 18858 | 0.002 |
| 18859 | 0.003 |
| 18860 | 0.001 |
| 18861 | 0.002 |
| 18862 | 0.008 |
| 18863 | 0.002 |
| 18864 | 0.002 |
| 18865 | 0.004 |
| 18866 | 0.001 |
| 18867 | 0.01 |
| 18868 | 0.013 |
| 18869 | 0.003 |
| 18870 | 0.002 |
| 18871 | 0.003 |
| 18872 | 0.003 |
| 18873 | 0.001 |
| 18874 | 0.001 |
| 18875 | 0.004 |
| 18876 | 0.006 |
| 18877 | 0.002 |
| 18878 | 0.007 |
| 18879 | 0.01 |
| 18880 | 0.004 |
| 18881 | 0.001 |
| 18882 | 0.002 |
| 18883 | 0.005 |
| 18884 | 0.005 |
| 18885 | 0.001 |
| 18886 | 0.004 |
| 18887 | 0.006 |
| 18888 | 0.011 |
| 18889 | 0.001 |
| 18890 | 0.003 |
| 18891 | 0.003 |
| 18892 | 0.008 |
| 18893 | 0.006 |
| 18894 | 0.006 |
| 18895 | 0.003 |
| 18896 | 0.003 |
| 18897 | 0.004 |
| 18898 | 0.002 |
| 18899 | 0.007 |
| 18900 | 0.006 |
| 18901 | 0.01 |
| 18902 | 0.003 |
| 18903 | 0.004 |
| 18904 | 0.005 |
| 18905 | 0.005 |
| 18906 | 0.004 |
| 18907 | 0.002 |
| 18908 | 0.005 |
| 18909 | 0.006 |
| 18910 | 0.005 |
| 18911 | 0.001 |
| 18912 | 0.003 |
| 18913 | 0.004 |
| 18914 | 0.004 |
| 18915 | 0.002 |
| 18916 | 0.004 |
| 18917 | 0.006 |
| 18918 | 0.001 |
| 18919 | 0.003 |
| 18920 | 0.003 |
| 18921 | 0.005 |
| 18922 | 0.01 |
| 18923 | 0.003 |
| 18924 | 0.002 |
| 18925 | 0.007 |
| 18926 | 0.001 |
| 18927 | 0.006 |
| 18928 | 0.004 |
| 18929 | 0.004 |
| 18930 | 0.003 |
| 18931 | 0.003 |
| 18932 | 0.003 |
| 18933 | 0.005 |
| 18934 | 0.002 |
| 18935 | 0.002 |
| 18936 | 0.001 |
| 18937 | 0.006 |
| 18938 | 0.003 |
| 18939 | 0.003 |
| 18940 | 0.004 |
| 18941 | 0.009 |
| 18942 | 0.002 |
| 18943 | 0.003 |
| 18944 | 0.003 |
| 18945 | 0.004 |
| 18946 | 0.003 |
| 18947 | 0.004 |
| 18948 | 0.004 |
| 18949 | 0.002 |
| 18950 | 0.008 |
| 18951 | 0.003 |
| 18952 | 0.005 |
| 18953 | 0.009 |
| 18954 | 0.002 |
| 18955 | 0.003 |
| 18956 | 0.002 |
| 18957 | 0.007 |
| 18958 | 0.003 |
| 18959 | 0.002 |
| 18960 | 0.004 |
| 18961 | 0.004 |
| 18962 | 0.001 |
| 18963 | 0.002 |
| 18964 | 0.002 |
| 18965 | 0.002 |
| 18966 | 0.004 |
| 18967 | 0.004 |
| 18968 | 0.004 |
| 18969 | 0.006 |
| 18970 | 0.004 |
| 18971 | 0.001 |
| 18972 | 0.006 |
| 18973 | 0.003 |
| 18974 | 0.005 |
| 18975 | 0.001 |
| 18976 | 0.006 |
| 18977 | 0.005 |
| 18978 | 0.002 |
| 18979 | 0.003 |
| 18980 | 0.005 |
| 18981 | 0.007 |
| 18982 | 0.004 |
| 18983 | 0.002 |
| 18984 | 0.004 |
| 18985 | 0.002 |
| 18986 | 0.004 |
| 18987 | 0.001 |
| 18988 | 0.003 |
| 18989 | 0.004 |
| 18990 | 0.003 |
| 18991 | 0.003 |
| 18992 | 0.006 |
| 18993 | 0.001 |
| 18994 | 0.004 |
| 18995 | 0.004 |
| 18996 | 0.004 |
| 18997 | 0.004 |
| 18998 | 0.004 |
| 18999 | 0.002 |
| 19000 | 0.002 |
| 19001 | 0.01 |
| 19002 | 0.002 |
| 19003 | 0.002 |
| 19004 | 0.004 |
| 19005 | 0.006 |
| 19006 | 0.006 |
| 19007 | 0.003 |
| 19008 | 0.002 |
| 19009 | 0.005 |
| 19010 | 0.007 |
| 19011 | 0.004 |
| 19012 | 0.007 |
| 19013 | 0.008 |
| 19014 | 0.006 |
| 19015 | 0.003 |
| 19016 | 0.004 |
| 19017 | 0.005 |
| 19018 | 0.001 |
| 19019 | 0.005 |
| 19020 | 0.004 |
| 19021 | 0.007 |
| 19022 | 0.004 |
| 19023 | 0.008 |
| 19024 | 0.004 |
| 19025 | 0.008 |
| 19026 | 0.004 |
| 19027 | 0.003 |
| 19028 | 0.006 |
| 19029 | 0.008 |
| 19030 | 0.004 |
| 19031 | 0.006 |
| 19032 | 0.009 |
| 19033 | 0.003 |
| 19034 | 0.004 |
| 19035 | 0.008 |
| 19036 | 0.01 |
| 19037 | 0.005 |
| 19038 | 0.002 |
| 19039 | 0.005 |
| 19040 | 0.004 |
| 19041 | 0.007 |
| 19042 | 0.004 |
| 19043 | 0.004 |
| 19044 | 0.005 |
| 19045 | 0.007 |
| 19046 | 0.004 |
| 19047 | 0.006 |
| 19048 | 0.004 |
| 19049 | 0.007 |
| 19050 | 0.001 |
| 19051 | 0.003 |
| 19052 | 0.006 |
| 19053 | 0.007 |
| 19054 | 0.002 |
| 19055 | 0.001 |
| 19056 | 0.004 |
| 19057 | 0.005 |
| 19058 | 0.003 |
| 19059 | 0.007 |
| 19060 | 0.002 |
| 19061 | 0.002 |
| 19062 | 0.003 |
| 19063 | 0.005 |
| 19064 | 0.003 |
| 19065 | 0.003 |
| 19066 | 0.002 |
| 19067 | 0.001 |
| 19068 | 0.009 |
| 19069 | 0.003 |
| 19070 | 0.005 |
| 19071 | 0.004 |
| 19072 | 0.007 |
| 19073 | 0.002 |
| 19074 | 0.002 |
| 19075 | 0.003 |
| 19076 | 0.007 |
| 19077 | 0.003 |
| 19078 | 0.002 |
| 19079 | 0.002 |
| 19080 | 0.004 |
| 19081 | 0.002 |
| 19082 | 0.006 |
| 19083 | 0.004 |
| 19084 | 0.005 |
| 19085 | 0.002 |
| 19086 | 0.007 |
| 19087 | 0.003 |
| 19088 | 0.006 |
| 19089 | 0.004 |
| 19090 | 0.002 |
| 19091 | 0.006 |
| 19092 | 0.006 |
| 19093 | 0.001 |
| 19094 | 0.001 |
| 19095 | 0.004 |
| 19096 | 0.004 |
| 19097 | 0.003 |
| 19098 | 0.003 |
| 19099 | 0.006 |
| 19100 | 0.001 |
| 19101 | 0.001 |
| 19102 | 0.003 |
| 19103 | 0.006 |
| 19104 | 0.003 |
| 19105 | 0.004 |
| 19106 | 0.006 |
| 19107 | 0.005 |
| 19108 | 0.003 |
| 19109 | 0.004 |
| 19110 | 0.001 |
| 19111 | 0.001 |
| 19112 | 0.005 |
| 19113 | 0.003 |
| 19114 | 0.004 |
| 19115 | 0 |
| 19116 | 0.003 |
| 19117 | 0.003 |
| 19118 | 0.001 |
| 19119 | 0.006 |
| 19120 | 0.004 |
| 19121 | 0.003 |
| 19122 | 0.003 |
| 19123 | 0.003 |
| 19124 | 0.002 |
| 19125 | 0.002 |
| 19126 | 0.004 |
| 19127 | 0.003 |
| 19128 | 0.009 |
| 19129 | 0.001 |
| 19130 | 0.002 |
| 19131 | 0.003 |
| 19132 | 0.002 |
| 19133 | 0.005 |
| 19134 | 0.006 |
| 19135 | 0.004 |
| 19136 | 0.003 |
| 19137 | 0.002 |
| 19138 | 0.004 |
| 19139 | 0.006 |
| 19140 | 0.006 |
| 19141 | 0.003 |
| 19142 | 0.002 |
| 19143 | 0.005 |
| 19144 | 0.002 |
| 19145 | 0.004 |
| 19146 | 0.005 |
| 19147 | 0.004 |
| 19148 | 0.005 |
| 19149 | 0.003 |
| 19150 | 0.001 |
| 19151 | 0.004 |
| 19152 | 0.003 |
| 19153 | 0.003 |
| 19154 | 0.003 |
| 19155 | 0.005 |
| 19156 | 0.008 |
| 19157 | 0.003 |
| 19158 | 0.004 |
| 19159 | 0.003 |
| 19160 | 0.001 |
| 19161 | 0.003 |
| 19162 | 0.001 |
| 19163 | 0.002 |
| 19164 | 0.004 |
| 19165 | 0.003 |
| 19166 | 0.003 |
| 19167 | 0.01 |
| 19168 | 0.011 |
| 19169 | 0.003 |
| 19170 | 0.003 |
| 19171 | 0.002 |
| 19172 | 0.006 |
| 19173 | 0.002 |
| 19174 | 0.003 |
| 19175 | 0.003 |
| 19176 | 0.005 |
| 19177 | 0.006 |
| 19178 | 0.003 |
| 19179 | 0.005 |
| 19180 | 0.003 |
| 19181 | 0.004 |
| 19182 | 0.003 |
| 19183 | 0.002 |
| 19184 | 0.007 |
| 19185 | 0.002 |
| 19186 | 0.002 |
| 19187 | 0.004 |
| 19188 | 0.008 |
| 19189 | 0.007 |
| 19190 | 0.002 |
| 19191 | 0.005 |
| 19192 | 0.001 |
| 19193 | 0.003 |
| 19194 | 0.003 |
| 19195 | 0.003 |
| 19196 | 0.007 |
| 19197 | 0.011 |
| 19198 | 0.003 |
| 19199 | 0.005 |
| 19200 | 0.01 |
| 19201 | 0.007 |
| 19202 | 0.004 |
| 19203 | 0.006 |
| 19204 | 0.002 |
| 19205 | 0.001 |
| 19206 | 0.004 |
| 19207 | 0.006 |
| 19208 | 0.003 |
| 19209 | 0.005 |
| 19210 | 0.003 |
| 19211 | 0.002 |
| 19212 | 0.004 |
| 19213 | 0.002 |
| 19214 | 0.001 |
| 19215 | 0.003 |
| 19216 | 0.004 |
| 19217 | 0.006 |
| 19218 | 0.002 |
| 19219 | 0.001 |
| 19220 | 0.007 |
| 19221 | 0.002 |
| 19222 | 0.002 |
| 19223 | 0.003 |
| 19224 | 0.006 |
| 19225 | 0.005 |
| 19226 | 0.002 |
| 19227 | 0.006 |
| 19228 | 0.002 |
| 19229 | 0.004 |
| 19230 | 0.001 |
| 19231 | 0.001 |
| 19232 | 0.003 |
| 19233 | 0.006 |
| 19234 | 0.001 |
| 19235 | 0.012 |
| 19236 | 0.011 |
| 19237 | 0.002 |
| 19238 | 0.002 |
| 19239 | 0.004 |
| 19240 | 0.002 |
| 19241 | 0.004 |
| 19242 | 0.003 |
| 19243 | 0.004 |
| 19244 | 0.001 |
| 19245 | 0.005 |
| 19246 | 0.003 |
| 19247 | 0.004 |
| 19248 | 0.01 |
| 19249 | 0.01 |
| 19250 | 0.003 |
| 19251 | 0.002 |
| 19252 | 0.004 |
| 19253 | 0.002 |
| 19254 | 0.003 |
| 19255 | 0.001 |
| 19256 | 0.001 |
| 19257 | 0.003 |
| 19258 | 0.001 |
| 19259 | 0.002 |
| 19260 | 0 |
| 19261 | 0.007 |
| 19262 | 0.007 |
| 19263 | 0.005 |
| 19264 | 0.007 |
| 19265 | 0.003 |
| 19266 | 0.003 |
| 19267 | 0.002 |
| 19268 | 0.002 |
| 19269 | 0.001 |
| 19270 | 0.006 |
| 19271 | 0.001 |
| 19272 | 0.005 |
| 19273 | 0.001 |
| 19274 | 0.003 |
| 19275 | 0.003 |
| 19276 | 0.003 |
| 19277 | 0.006 |
| 19278 | 0.006 |
| 19279 | 0.004 |
| 19280 | 0.004 |
| 19281 | 0.005 |
| 19282 | 0.004 |
| 19283 | 0.007 |
| 19284 | 0.005 |
| 19285 | 0.005 |
| 19286 | 0.003 |
| 19287 | 0.006 |
| 19288 | 0.01 |
| 19289 | 0.008 |
| 19290 | 0.004 |
| 19291 | 0.004 |
| 19292 | 0.003 |
| 19293 | 0.002 |
| 19294 | 0.002 |
| 19295 | 0.004 |
| 19296 | 0 |
| 19297 | 0.002 |
| 19298 | 0.001 |
| 19299 | 0.001 |
| 19300 | 0.002 |
| 19301 | 0.003 |
| 19302 | 0.006 |
| 19303 | 0.002 |
| 19304 | 0.002 |
| 19305 | 0.002 |
| 19306 | 0.002 |
| 19307 | 0.009 |
| 19308 | 0.009 |
| 19309 | 0.001 |
| 19310 | 0.001 |
| 19311 | 0.003 |
| 19312 | 0.012 |
| 19313 | 0.003 |
| 19314 | 0.002 |
| 19315 | 0.004 |
| 19316 | 0.006 |
| 19317 | 0.002 |
| 19318 | 0.001 |
| 19319 | 0.007 |
| 19320 | 0.006 |
| 19321 | 0.01 |
| 19322 | 0.01 |
| 19323 | 0.005 |
| 19324 | 0.002 |
| 19325 | 0.006 |
| 19326 | 0.002 |
| 19327 | 0.006 |
| 19328 | 0.008 |
| 19329 | 0.006 |
| 19330 | 0.005 |
| 19331 | 0.004 |
| 19332 | 0.005 |
| 19333 | 0.003 |
| 19334 | 0.007 |
| 19335 | 0.007 |
| 19336 | 0.011 |
| 19337 | 0.006 |
| 19338 | 0.002 |
| 19339 | 0.005 |
| 19340 | 0.004 |
| 19341 | 0.003 |
| 19342 | 0.007 |
| 19343 | 0.001 |
| 19344 | 0.001 |
| 19345 | 0.002 |
| 19346 | 0.001 |
| 19347 | 0.003 |
| 19348 | 0.002 |
| 19349 | 0.003 |
| 19350 | 0.006 |
| 19351 | 0.002 |
| 19352 | 0.002 |
| 19353 | 0.005 |
| 19354 | 0.003 |
| 19355 | 0.003 |
| 19356 | 0.005 |
| 19357 | 0.009 |
| 19358 | 0.005 |
| 19359 | 0.006 |
| 19360 | 0.004 |
| 19361 | 0.002 |
| 19362 | 0.001 |
| 19363 | 0.002 |
| 19364 | 0.004 |
| 19365 | 0.003 |
| 19366 | 0.001 |
| 19367 | 0.004 |
| 19368 | 0.005 |
| 19369 | 0.006 |
| 19370 | 0.002 |
| 19371 | 0.005 |
| 19372 | 0.01 |
| 19373 | 0.012 |
| 19374 | 0.003 |
| 19375 | 0.003 |
| 19376 | 0.005 |
| 19377 | 0.001 |
| 19378 | 0.004 |
| 19379 | 0.004 |
| 19380 | 0.003 |
| 19381 | 0.005 |
| 19382 | 0.003 |
| 19383 | 0.003 |
| 19384 | 0.008 |
| 19385 | 0.005 |
| 19386 | 0 |
| 19387 | 0.002 |
| 19388 | 0.004 |
| 19389 | 0.001 |
| 19390 | 0.003 |
| 19391 | 0.01 |
| 19392 | 0.003 |
| 19393 | 0.002 |
| 19394 | 0.002 |
| 19395 | 0.004 |
| 19396 | 0.004 |
| 19397 | 0.003 |
| 19398 | 0.003 |
| 19399 | 0.002 |
| 19400 | 0.01 |
| 19401 | 0.002 |
| 19402 | 0.005 |
| 19403 | 0.005 |
| 19404 | 0.005 |
| 19405 | 0.004 |
| 19406 | 0.002 |
| 19407 | 0.009 |
| 19408 | 0.007 |
| 19409 | 0.002 |
| 19410 | 0.001 |
| 19411 | 0.006 |
| 19412 | 0.005 |
| 19413 | 0.003 |
| 19414 | 0.001 |
| 19415 | 0.005 |
| 19416 | 0.005 |
| 19417 | 0.003 |
| 19418 | 0.003 |
| 19419 | 0.003 |
| 19420 | 0.002 |
| 19421 | 0.003 |
| 19422 | 0.004 |
| 19423 | 0.003 |
| 19424 | 0.002 |
| 19425 | 0.001 |
| 19426 | 0.004 |
| 19427 | 0.003 |
| 19428 | 0.003 |
| 19429 | 0.002 |
| 19430 | 0.008 |
| 19431 | 0.005 |
| 19432 | 0.002 |
| 19433 | 0.002 |
| 19434 | 0.002 |
| 19435 | 0.014 |
| 19436 | 0.012 |
| 19437 | 0.001 |
| 19438 | 0.002 |
| 19439 | 0.009 |
| 19440 | 0.006 |
| 19441 | 0.004 |
| 19442 | 0.003 |
| 19443 | 0.009 |
| 19444 | 0.005 |
| 19445 | 0.002 |
| 19446 | 0.004 |
| 19447 | 0.007 |
| 19448 | 0.004 |
| 19449 | 0.002 |
| 19450 | 0.001 |
| 19451 | 0.001 |
| 19452 | 0.002 |
| 19453 | 0.001 |
| 19454 | 0.006 |
| 19455 | 0.005 |
| 19456 | 0.002 |
| 19457 | 0.002 |
| 19458 | 0.004 |
| 19459 | 0.008 |
| 19460 | 0.004 |
| 19461 | 0.004 |
| 19462 | 0.006 |
| 19463 | 0.004 |
| 19464 | 0.012 |
| 19465 | 0.004 |
| 19466 | 0.006 |
| 19467 | 0.005 |
| 19468 | 0.001 |
| 19469 | 0.005 |
| 19470 | 0.003 |
| 19471 | 0.004 |
| 19472 | 0.005 |
| 19473 | 0.002 |
| 19474 | 0.001 |
| 19475 | 0.002 |
| 19476 | 0.004 |
| 19477 | 0.006 |
| 19478 | 0.003 |
| 19479 | 0.002 |
| 19480 | 0.006 |
| 19481 | 0.007 |
| 19482 | 0.001 |
| 19483 | 0.004 |
| 19484 | 0.009 |
| 19485 | 0.01 |
| 19486 | 0.002 |
| 19487 | 0.001 |
| 19488 | 0.002 |
| 19489 | 0.006 |
| 19490 | 0.002 |
| 19491 | 0.004 |
| 19492 | 0.001 |
| 19493 | 0.007 |
| 19494 | 0.006 |
| 19495 | 0.004 |
| 19496 | 0.004 |
| 19497 | 0.002 |
| 19498 | 0.002 |
| 19499 | 0.001 |
| 19500 | 0.01 |
| 19501 | 0.009 |
| 19502 | 0.005 |
| 19503 | 0.003 |
| 19504 | 0.006 |
| 19505 | 0.007 |
| 19506 | 0.001 |
| 19507 | 0.003 |
| 19508 | 0.007 |
| 19509 | 0.008 |
| 19510 | 0.003 |
| 19511 | 0.003 |
| 19512 | 0.009 |
| 19513 | 0.009 |
| 19514 | 0.001 |
| 19515 | 0.003 |
| 19516 | 0.003 |
| 19517 | 0.004 |
| 19518 | 0.003 |
| 19519 | 0.004 |
| 19520 | 0.004 |
| 19521 | 0.004 |
| 19522 | 0.004 |
| 19523 | 0.006 |
| 19524 | 0.003 |
| 19525 | 0.002 |
| 19526 | 0.003 |
| 19527 | 0.008 |
| 19528 | 0.007 |
| 19529 | 0.001 |
| 19530 | 0.003 |
| 19531 | 0.008 |
| 19532 | 0.006 |
| 19533 | 0.006 |
| 19534 | 0.003 |
| 19535 | 0.009 |
| 19536 | 0.004 |
| 19537 | 0.001 |
| 19538 | 0.002 |
| 19539 | 0.003 |
| 19540 | 0.006 |
| 19541 | 0.002 |
| 19542 | 0.002 |
| 19543 | 0.005 |
| 19544 | 0.006 |
| 19545 | 0.003 |
| 19546 | 0.003 |
| 19547 | 0.01 |
| 19548 | 0.004 |
| 19549 | 0.006 |
| 19550 | 0.006 |
| 19551 | 0.005 |
| 19552 | 0.011 |
| 19553 | 0.003 |
| 19554 | 0.002 |
| 19555 | 0.005 |
| 19556 | 0.004 |
| 19557 | 0.002 |
| 19558 | 0.003 |
| 19559 | 0.004 |
| 19560 | 0.002 |
| 19561 | 0.003 |
| 19562 | 0.003 |
| 19563 | 0.006 |
| 19564 | 0.008 |
| 19565 | 0.008 |
| 19566 | 0.004 |
| 19567 | 0.003 |
| 19568 | 0.006 |
| 19569 | 0.004 |
| 19570 | 0.002 |
| 19571 | 0.002 |
| 19572 | 0.007 |
| 19573 | 0.005 |
| 19574 | 0.003 |
| 19575 | 0.003 |
| 19576 | 0.003 |
| 19577 | 0.002 |
| 19578 | 0.002 |
| 19579 | 0.002 |
| 19580 | 0.002 |
| 19581 | 0.004 |
| 19582 | 0.009 |
| 19583 | 0.002 |
| 19584 | 0.001 |
| 19585 | 0.008 |
| 19586 | 0.006 |
| 19587 | 0.004 |
| 19588 | 0.005 |
| 19589 | 0.003 |
| 19590 | 0.008 |
| 19591 | 0.006 |
| 19592 | 0.005 |
| 19593 | 0.005 |
| 19594 | 0.003 |
| 19595 | 0.004 |
| 19596 | 0.005 |
| 19597 | 0.001 |
| 19598 | 0.002 |
| 19599 | 0.002 |
| 19600 | 0.007 |
| 19601 | 0.001 |
| 19602 | 0.004 |
| 19603 | 0.001 |
| 19604 | 0.005 |
| 19605 | 0.003 |
| 19606 | 0.002 |
| 19607 | 0.006 |
| 19608 | 0.003 |
| 19609 | 0.003 |
| 19610 | 0.004 |
| 19611 | 0.004 |
| 19612 | 0.002 |
| 19613 | 0.001 |
| 19614 | 0.003 |
| 19615 | 0.004 |
| 19616 | 0.004 |
| 19617 | 0.003 |
| 19618 | 0.004 |
| 19619 | 0.002 |
| 19620 | 0.003 |
| 19621 | 0.006 |
| 19622 | 0.004 |
| 19623 | 0.002 |
| 19624 | 0.003 |
| 19625 | 0.003 |
| 19626 | 0.006 |
| 19627 | 0.004 |
| 19628 | 0.002 |
| 19629 | 0.002 |
| 19630 | 0.004 |
| 19631 | 0.004 |
| 19632 | 0.002 |
| 19633 | 0.005 |
| 19634 | 0.003 |
| 19635 | 0.007 |
| 19636 | 0.003 |
| 19637 | 0.004 |
| 19638 | 0.009 |
| 19639 | 0.007 |
| 19640 | 0.002 |
| 19641 | 0.002 |
| 19642 | 0.005 |
| 19643 | 0.004 |
| 19644 | 0.004 |
| 19645 | 0.009 |
| 19646 | 0.006 |
| 19647 | 0.002 |
| 19648 | 0.004 |
| 19649 | 0.004 |
| 19650 | 0.004 |
| 19651 | 0.007 |
| 19652 | 0.009 |
| 19653 | 0.003 |
| 19654 | 0.004 |
| 19655 | 0.004 |
| 19656 | 0.009 |
| 19657 | 0.009 |
| 19658 | 0.003 |
| 19659 | 0.002 |
| 19660 | 0.005 |
| 19661 | 0.005 |
| 19662 | 0.003 |
| 19663 | 0.002 |
| 19664 | 0.002 |
| 19665 | 0.006 |
| 19666 | 0.005 |
| 19667 | 0.003 |
| 19668 | 0.002 |
| 19669 | 0.007 |
| 19670 | 0.003 |
| 19671 | 0.002 |
| 19672 | 0.001 |
| 19673 | 0.005 |
| 19674 | 0.004 |
| 19675 | 0.001 |
| 19676 | 0.004 |
| 19677 | 0.002 |
| 19678 | 0.003 |
| 19679 | 0.003 |
| 19680 | 0.01 |
| 19681 | 0.004 |
| 19682 | 0.002 |
| 19683 | 0.003 |
| 19684 | 0.004 |
| 19685 | 0.013 |
| 19686 | 0.004 |
| 19687 | 0.004 |
| 19688 | 0.004 |
| 19689 | 0.009 |
| 19690 | 0.001 |
| 19691 | 0.003 |
| 19692 | 0.006 |
| 19693 | 0.004 |
| 19694 | 0.001 |
| 19695 | 0.005 |
| 19696 | 0.008 |
| 19697 | 0.008 |
| 19698 | 0.01 |
| 19699 | 0.003 |
| 19700 | 0.003 |
| 19701 | 0.002 |
| 19702 | 0.009 |
| 19703 | 0.006 |
| 19704 | 0.005 |
| 19705 | 0.004 |
| 19706 | 0.003 |
| 19707 | 0.003 |
| 19708 | 0.01 |
| 19709 | 0.008 |
| 19710 | 0.004 |
| 19711 | 0.003 |
| 19712 | 0.004 |
| 19713 | 0.006 |
| 19714 | 0.007 |
| 19715 | 0.002 |
| 19716 | 0.004 |
| 19717 | 0.002 |
| 19718 | 0.003 |
| 19719 | 0.003 |
| 19720 | 0.002 |
| 19721 | 0.002 |
| 19722 | 0.004 |
| 19723 | 0.006 |
| 19724 | 0.007 |
| 19725 | 0.003 |
| 19726 | 0.002 |
| 19727 | 0.002 |
| 19728 | 0.003 |
| 19729 | 0.003 |
| 19730 | 0.002 |
| 19731 | 0.003 |
| 19732 | 0.004 |
| 19733 | 0.002 |
| 19734 | 0.002 |
| 19735 | 0.002 |
| 19736 | 0.003 |
| 19737 | 0.012 |
| 19738 | 0.001 |
| 19739 | 0.001 |
| 19740 | 0.004 |
| 19741 | 0.008 |
| 19742 | 0.004 |
| 19743 | 0.004 |
| 19744 | 0.005 |
| 19745 | 0.003 |
| 19746 | 0.002 |
| 19747 | 0.007 |
| 19748 | 0.01 |
| 19749 | 0.004 |
| 19750 | 0.004 |
| 19751 | 0.003 |
| 19752 | 0.003 |
| 19753 | 0.001 |
| 19754 | 0.002 |
| 19755 | 0.003 |
| 19756 | 0.007 |
| 19757 | 0.005 |
| 19758 | 0.002 |
| 19759 | 0.004 |
| 19760 | 0.005 |
| 19761 | 0.006 |
| 19762 | 0.003 |
| 19763 | 0.002 |
| 19764 | 0.003 |
| 19765 | 0.002 |
| 19766 | 0.002 |
| 19767 | 0.002 |
| 19768 | 0.001 |
| 19769 | 0.003 |
| 19770 | 0.003 |
| 19771 | 0.005 |
| 19772 | 0.004 |
| 19773 | 0.006 |
| 19774 | 0.002 |
| 19775 | 0.002 |
| 19776 | 0.003 |
| 19777 | 0.006 |
| 19778 | 0.003 |
| 19779 | 0.002 |
| 19780 | 0.004 |
| 19781 | 0.008 |
| 19782 | 0.004 |
| 19783 | 0.005 |
| 19784 | 0.004 |
| 19785 | 0.001 |
| 19786 | 0.002 |
| 19787 | 0.003 |
| 19788 | 0.006 |
| 19789 | 0.005 |
| 19790 | 0.003 |
| 19791 | 0.005 |
| 19792 | 0.003 |
| 19793 | 0.005 |
| 19794 | 0.002 |
| 19795 | 0.003 |
| 19796 | 0.007 |
| 19797 | 0.007 |
| 19798 | 0.001 |
| 19799 | 0.002 |
| 19800 | 0.008 |
| 19801 | 0.014 |
| 19802 | 0.002 |
| 19803 | 0.003 |
| 19804 | 0.002 |
| 19805 | 0.004 |
| 19806 | 0.004 |
| 19807 | 0.008 |
| 19808 | 0.007 |
| 19809 | 0.002 |
| 19810 | 0.003 |
| 19811 | 0.005 |
| 19812 | 0.006 |
| 19813 | 0.002 |
| 19814 | 0.001 |
| 19815 | 0.003 |
| 19816 | 0.002 |
| 19817 | 0.003 |
| 19818 | 0.002 |
| 19819 | 0.003 |
| 19820 | 0.005 |
| 19821 | 0.002 |
| 19822 | 0.002 |
| 19823 | 0.003 |
| 19824 | 0.007 |
| 19825 | 0.003 |
| 19826 | 0.001 |
| 19827 | 0.002 |
| 19828 | 0.006 |
| 19829 | 0.002 |
| 19830 | 0.002 |
| 19831 | 0.007 |
| 19832 | 0.003 |
| 19833 | 0.004 |
| 19834 | 0.005 |
| 19835 | 0.002 |
| 19836 | 0.003 |
| 19837 | 0.001 |
| 19838 | 0.002 |
| 19839 | 0.007 |
| 19840 | 0.009 |
| 19841 | 0.003 |
| 19842 | 0.002 |
| 19843 | 0.008 |
| 19844 | 0.009 |
| 19845 | 0.002 |
| 19846 | 0.003 |
| 19847 | 0.005 |
| 19848 | 0.006 |
| 19849 | 0.003 |
| 19850 | 0.003 |
| 19851 | 0.008 |
| 19852 | 0.003 |
| 19853 | 0.002 |
| 19854 | 0.005 |
| 19855 | 0.005 |
| 19856 | 0.004 |
| 19857 | 0.004 |
| 19858 | 0.006 |
| 19859 | 0.003 |
| 19860 | 0.007 |
| 19861 | 0.003 |
| 19862 | 0.003 |
| 19863 | 0.006 |
| 19864 | 0.005 |
| 19865 | 0.011 |
| 19866 | 0.004 |
| 19867 | 0.006 |
| 19868 | 0.004 |
| 19869 | 0.002 |
| 19870 | 0.003 |
| 19871 | 0.004 |
| 19872 | 0.004 |
| 19873 | 0.007 |
| 19874 | 0.002 |
| 19875 | 0.005 |
| 19876 | 0.007 |
| 19877 | 0.005 |
| 19878 | 0.002 |
| 19879 | 0.004 |
| 19880 | 0.007 |
| 19881 | 0.005 |
| 19882 | 0.001 |
| 19883 | 0.003 |
| 19884 | 0.003 |
| 19885 | 0.008 |
| 19886 | 0.001 |
| 19887 | 0.004 |
| 19888 | 0.002 |
| 19889 | 0 |
| 19890 | 0.001 |
| 19891 | 0.005 |
| 19892 | 0.006 |
| 19893 | 0.009 |
| 19894 | 0.008 |
| 19895 | 0.005 |
| 19896 | 0.006 |
| 19897 | 0.004 |
| 19898 | 0.005 |
| 19899 | 0.004 |
| 19900 | 0.001 |
| 19901 | 0.004 |
| 19902 | 0.004 |
| 19903 | 0.005 |
| 19904 | 0.003 |
| 19905 | 0.004 |
| 19906 | 0.009 |
| 19907 | 0.002 |
| 19908 | 0.004 |
| 19909 | 0.002 |
| 19910 | 0.005 |
| 19911 | 0.005 |
| 19912 | 0.002 |
| 19913 | 0.007 |
| 19914 | 0.004 |
| 19915 | 0.005 |
| 19916 | 0.003 |
| 19917 | 0.007 |
| 19918 | 0.003 |
| 19919 | 0.006 |
| 19920 | 0.007 |
| 19921 | 0.002 |
| 19922 | 0.006 |
| 19923 | 0.005 |
| 19924 | 0.003 |
| 19925 | 0.003 |
| 19926 | 0.005 |
| 19927 | 0.008 |
| 19928 | 0.008 |
| 19929 | 0.008 |
| 19930 | 0.005 |
| 19931 | 0.004 |
| 19932 | 0.006 |
| 19933 | 0.005 |
| 19934 | 0.006 |
| 19935 | 0.004 |
| 19936 | 0.004 |
| 19937 | 0.006 |
| 19938 | 0.005 |
| 19939 | 0.005 |
| 19940 | 0.004 |
| 19941 | 0.002 |
| 19942 | 0.006 |
| 19943 | 0.002 |
| 19944 | 0.005 |
| 19945 | 0.004 |
| 19946 | 0.007 |
| 19947 | 0.004 |
| 19948 | 0.001 |
| 19949 | 0.005 |
| 19950 | 0.001 |
| 19951 | 0.002 |
| 19952 | 0.006 |
| 19953 | 0.001 |
| 19954 | 0.005 |
| 19955 | 0.005 |
| 19956 | 0.005 |
| 19957 | 0.002 |
| 19958 | 0.004 |
| 19959 | 0.003 |
| 19960 | 0.003 |
| 19961 | 0.004 |
| 19962 | 0.007 |
| 19963 | 0.002 |
| 19964 | 0.002 |
| 19965 | 0.006 |
| 19966 | 0.004 |
| 19967 | 0.001 |
| 19968 | 0.003 |
| 19969 | 0.001 |
| 19970 | 0.006 |
| 19971 | 0.007 |
| 19972 | 0.008 |
| 19973 | 0.002 |
| 19974 | 0.004 |
| 19975 | 0.002 |
| 19976 | 0.002 |
| 19977 | 0.004 |
| 19978 | 0.012 |
| 19979 | 0.012 |
| 19980 | 0.011 |
| 19981 | 0.002 |
| 19982 | 0.002 |
| 19983 | 0.004 |
| 19984 | 0.006 |
| 19985 | 0.005 |
| 19986 | 0.003 |
| 19987 | 0.003 |
| 19988 | 0.004 |
| 19989 | 0.005 |
| 19990 | 0.003 |
| 19991 | 0.009 |
| 19992 | 0.006 |
| 19993 | 0.004 |
| 19994 | 0.003 |
| 19995 | 0.004 |
| 19996 | 0.006 |
| 19997 | 0.006 |
| 19998 | 0.002 |
| 19999 | 0.001 |
| 20000 | 0.004 |
| 20001 | 0.004 |
| 20002 | 0.002 |
| 20003 | 0.003 |
| 20004 | 0.004 |
| 20005 | 0.003 |
| 20006 | 0.003 |
| 20007 | 0.005 |
| 20008 | 0.008 |
| 20009 | 0.003 |
| 20010 | 0.003 |
| 20011 | 0.003 |
| 20012 | 0.006 |
| 20013 | 0.002 |
| 20014 | 0.001 |
| 20015 | 0.004 |
| 20016 | 0.005 |
| 20017 | 0.001 |
| 20018 | 0.005 |
| 20019 | 0.003 |
| 20020 | 0.003 |
| 20021 | 0.003 |
| 20022 | 0.004 |
| 20023 | 0.006 |
| 20024 | 0.007 |
| 20025 | 0.002 |
| 20026 | 0.001 |
| 20027 | 0.002 |
| 20028 | 0.003 |
| 20029 | 0.002 |
| 20030 | 0.006 |
| 20031 | 0.003 |
| 20032 | 0.004 |
| 20033 | 0.003 |
| 20034 | 0.002 |
| 20035 | 0.005 |
| 20036 | 0.005 |
| 20037 | 0.005 |
| 20038 | 0.005 |
| 20039 | 0.003 |
| 20040 | 0.006 |
| 20041 | 0.003 |
| 20042 | 0.001 |
| 20043 | 0.005 |
| 20044 | 0.004 |
| 20045 | 0.001 |
| 20046 | 0.003 |
| 20047 | 0.003 |
| 20048 | 0.001 |
| 20049 | 0.007 |
| 20050 | 0.004 |
| 20051 | 0.003 |
| 20052 | 0.006 |
| 20053 | 0.003 |
| 20054 | 0.002 |
| 20055 | 0.001 |
| 20056 | 0.005 |
| 20057 | 0.005 |
| 20058 | 0.003 |
| 20059 | 0.003 |
| 20060 | 0.002 |
| 20061 | 0.007 |
| 20062 | 0.004 |
| 20063 | 0.003 |
| 20064 | 0.006 |
| 20065 | 0.009 |
| 20066 | 0.007 |
| 20067 | 0.003 |
| 20068 | 0.002 |
| 20069 | 0.005 |
| 20070 | 0.002 |
| 20071 | 0.002 |
| 20072 | 0.008 |
| 20073 | 0.005 |
| 20074 | 0.004 |
| 20075 | 0.004 |
| 20076 | 0.005 |
| 20077 | 0.007 |
| 20078 | 0.002 |
| 20079 | 0.002 |
| 20080 | 0.007 |
| 20081 | 0.004 |
| 20082 | 0.002 |
| 20083 | 0.004 |
| 20084 | 0.003 |
| 20085 | 0.006 |
| 20086 | 0.004 |
| 20087 | 0.003 |
| 20088 | 0.003 |
| 20089 | 0.004 |
| 20090 | 0.002 |
| 20091 | 0.002 |
| 20092 | 0.004 |
| 20093 | 0.007 |
| 20094 | 0.004 |
| 20095 | 0.005 |
| 20096 | 0.006 |
| 20097 | 0.002 |
| 20098 | 0.001 |
| 20099 | 0.001 |
| 20100 | 0.006 |
| 20101 | 0.002 |
| 20102 | 0.004 |
| 20103 | 0.004 |
| 20104 | 0.004 |
| 20105 | 0.003 |
| 20106 | 0.003 |
| 20107 | 0.003 |
| 20108 | 0.005 |
| 20109 | 0.006 |
| 20110 | 0.005 |
| 20111 | 0.004 |
| 20112 | 0.003 |
| 20113 | 0.003 |
| 20114 | 0.002 |
| 20115 | 0.003 |
| 20116 | 0.002 |
| 20117 | 0.002 |
| 20118 | 0.002 |
| 20119 | 0.004 |
| 20120 | 0.003 |
| 20121 | 0.005 |
| 20122 | 0.008 |
| 20123 | 0.005 |
| 20124 | 0.004 |
| 20125 | 0.003 |
| 20126 | 0.005 |
| 20127 | 0.003 |
| 20128 | 0.007 |
| 20129 | 0.001 |
| 20130 | 0.002 |
| 20131 | 0.005 |
| 20132 | 0.002 |
| 20133 | 0.003 |
| 20134 | 0.004 |
| 20135 | 0.009 |
| 20136 | 0.005 |
| 20137 | 0.002 |
| 20138 | 0.004 |
| 20139 | 0.003 |
| 20140 | 0.006 |
| 20141 | 0.003 |
| 20142 | 0.002 |
| 20143 | 0.005 |
| 20144 | 0.009 |
| 20145 | 0.005 |
| 20146 | 0.004 |
| 20147 | 0.005 |
| 20148 | 0.009 |
| 20149 | 0.005 |
| 20150 | 0.003 |
| 20151 | 0.007 |
| 20152 | 0.007 |
| 20153 | 0.002 |
| 20154 | 0.003 |
| 20155 | 0.003 |
| 20156 | 0.001 |
| 20157 | 0.002 |
| 20158 | 0.001 |
| 20159 | 0.005 |
| 20160 | 0.004 |
| 20161 | 0.004 |
| 20162 | 0.003 |
| 20163 | 0.004 |
| 20164 | 0.003 |
| 20165 | 0.003 |
| 20166 | 0.003 |
| 20167 | 0.004 |
| 20168 | 0.003 |
| 20169 | 0.005 |
| 20170 | 0.002 |
| 20171 | 0.002 |
| 20172 | 0.004 |
| 20173 | 0.003 |
| 20174 | 0.001 |
| 20175 | 0.004 |
| 20176 | 0.003 |
| 20177 | 0.002 |
| 20178 | 0.002 |
| 20179 | 0.003 |
| 20180 | 0.001 |
| 20181 | 0.003 |
| 20182 | 0.004 |
| 20183 | 0.001 |
| 20184 | 0.003 |
| 20185 | 0.003 |
| 20186 | 0.002 |
| 20187 | 0.001 |
| 20188 | 0.001 |
| 20189 | 0.004 |
| 20190 | 0.007 |
| 20191 | 0.002 |
| 20192 | 0.002 |
| 20193 | 0.001 |
| 20194 | 0.002 |
| 20195 | 0.006 |
| 20196 | 0 |
| 20197 | 0.002 |
| 20198 | 0.003 |
| 20199 | 0.003 |
| 20200 | 0.005 |
| 20201 | 0.002 |
| 20202 | 0.005 |
| 20203 | 0.004 |
| 20204 | 0.008 |
| 20205 | 0.006 |
| 20206 | 0.004 |
| 20207 | 0.006 |
| 20208 | 0.003 |
| 20209 | 0.002 |
| 20210 | 0.002 |
| 20211 | 0.007 |
| 20212 | 0.004 |
| 20213 | 0.001 |
| 20214 | 0.001 |
| 20215 | 0.006 |
| 20216 | 0.008 |
| 20217 | 0.005 |
| 20218 | 0.006 |
| 20219 | 0.001 |
| 20220 | 0.005 |
| 20221 | 0.002 |
| 20222 | 0.005 |
| 20223 | 0.005 |
| 20224 | 0.006 |
| 20225 | 0.004 |
| 20226 | 0.006 |
| 20227 | 0.012 |
| 20228 | 0.011 |
| 20229 | 0.004 |
| 20230 | 0.001 |
| 20231 | 0.007 |
| 20232 | 0.004 |
| 20233 | 0.002 |
| 20234 | 0.002 |
| 20235 | 0.008 |
| 20236 | 0.011 |
| 20237 | 0.002 |
| 20238 | 0.002 |
| 20239 | 0.004 |
| 20240 | 0.008 |
| 20241 | 0.003 |
| 20242 | 0.004 |
| 20243 | 0.003 |
| 20244 | 0.008 |
| 20245 | 0.003 |
| 20246 | 0.006 |
| 20247 | 0.004 |
| 20248 | 0.006 |
| 20249 | 0.003 |
| 20250 | 0.006 |
| 20251 | 0.003 |
| 20252 | 0.004 |
| 20253 | 0.003 |
| 20254 | 0.004 |
| 20255 | 0.004 |
| 20256 | 0.002 |
| 20257 | 0.006 |
| 20258 | 0.001 |
| 20259 | 0.007 |
| 20260 | 0.005 |
| 20261 | 0.004 |
| 20262 | 0.003 |
| 20263 | 0.003 |
| 20264 | 0.007 |
| 20265 | 0.003 |
| 20266 | 0.004 |
| 20267 | 0.004 |
| 20268 | 0.004 |
| 20269 | 0.003 |
| 20270 | 0.003 |
| 20271 | 0.004 |
| 20272 | 0.005 |
| 20273 | 0.002 |
| 20274 | 0.005 |
| 20275 | 0.004 |
| 20276 | 0.006 |
| 20277 | 0.005 |
| 20278 | 0.005 |
| 20279 | 0.002 |
| 20280 | 0.008 |
| 20281 | 0.006 |
| 20282 | 0.002 |
| 20283 | 0.006 |
| 20284 | 0.005 |
| 20285 | 0.008 |
| 20286 | 0.002 |
| 20287 | 0.003 |
| 20288 | 0.002 |
| 20289 | 0.004 |
| 20290 | 0.004 |
| 20291 | 0.004 |
| 20292 | 0.004 |
| 20293 | 0.004 |
| 20294 | 0.003 |
| 20295 | 0.004 |
| 20296 | 0.007 |
| 20297 | 0.003 |
| 20298 | 0.002 |
| 20299 | 0.004 |
| 20300 | 0.008 |
| 20301 | 0.004 |
| 20302 | 0.003 |
| 20303 | 0.003 |
| 20304 | 0.006 |
| 20305 | 0.005 |
| 20306 | 0.001 |
| 20307 | 0.003 |
| 20308 | 0.004 |
| 20309 | 0.002 |
| 20310 | 0.002 |
| 20311 | 0.005 |
| 20312 | 0.007 |
| 20313 | 0.003 |
| 20314 | 0.002 |
| 20315 | 0.004 |
| 20316 | 0.004 |
| 20317 | 0.003 |
| 20318 | 0.007 |
| 20319 | 0.005 |
| 20320 | 0.003 |
| 20321 | 0.004 |
| 20322 | 0.002 |
| 20323 | 0.003 |
| 20324 | 0.007 |
| 20325 | 0.009 |
| 20326 | 0.002 |
| 20327 | 0.003 |
| 20328 | 0.001 |
| 20329 | 0.003 |
| 20330 | 0.002 |
| 20331 | 0.002 |
| 20332 | 0 |
| 20333 | 0.005 |
| 20334 | 0.001 |
| 20335 | 0.002 |
| 20336 | 0.006 |
| 20337 | 0.004 |
| 20338 | 0.002 |
| 20339 | 0.006 |
| 20340 | 0.003 |
| 20341 | 0.004 |
| 20342 | 0.004 |
| 20343 | 0.004 |
| 20344 | 0.002 |
| 20345 | 0.006 |
| 20346 | 0.002 |
| 20347 | 0.003 |
| 20348 | 0.006 |
| 20349 | 0.002 |
| 20350 | 0.002 |
| 20351 | 0.002 |
| 20352 | 0.007 |
| 20353 | 0.004 |
| 20354 | 0.003 |
| 20355 | 0.001 |
| 20356 | 0.002 |
| 20357 | 0.004 |
| 20358 | 0.002 |
| 20359 | 0.01 |
| 20360 | 0.009 |
| 20361 | 0.003 |
| 20362 | 0.001 |
| 20363 | 0.006 |
| 20364 | 0.011 |
| 20365 | 0.007 |
| 20366 | 0.001 |
| 20367 | 0.005 |
| 20368 | 0.009 |
| 20369 | 0.01 |
| 20370 | 0.002 |
| 20371 | 0.004 |
| 20372 | 0.007 |
| 20373 | 0.008 |
| 20374 | 0.002 |
| 20375 | 0.005 |
| 20376 | 0.005 |
| 20377 | 0.001 |
| 20378 | 0.005 |
| 20379 | 0.004 |
| 20380 | 0.004 |
| 20381 | 0.001 |
| 20382 | 0.002 |
| 20383 | 0.002 |
| 20384 | 0.004 |
| 20385 | 0.004 |
| 20386 | 0.002 |
| 20387 | 0.004 |
| 20388 | 0.003 |
| 20389 | 0.005 |
| 20390 | 0.003 |
| 20391 | 0.004 |
| 20392 | 0.004 |
| 20393 | 0.002 |
| 20394 | 0.004 |
| 20395 | 0.003 |
| 20396 | 0.01 |
| 20397 | 0.009 |
| 20398 | 0.002 |
| 20399 | 0.003 |
| 20400 | 0.007 |
| 20401 | 0.007 |
| 20402 | 0.004 |
| 20403 | 0.003 |
| 20404 | 0.003 |
| 20405 | 0.004 |
| 20406 | 0.007 |
| 20407 | 0.005 |
| 20408 | 0.004 |
| 20409 | 0.005 |
| 20410 | 0.001 |
| 20411 | 0.006 |
| 20412 | 0.001 |
| 20413 | 0.003 |
| 20414 | 0.006 |
| 20415 | 0.006 |
| 20416 | 0.002 |
| 20417 | 0.002 |
| 20418 | 0.004 |
| 20419 | 0.004 |
| 20420 | 0.008 |
| 20421 | 0.005 |
| 20422 | 0.004 |
| 20423 | 0.004 |
| 20424 | 0.003 |
| 20425 | 0.001 |
| 20426 | 0.007 |
| 20427 | 0.005 |
| 20428 | 0.009 |
| 20429 | 0.001 |
| 20430 | 0.002 |
| 20431 | 0.006 |
| 20432 | 0.002 |
| 20433 | 0.001 |
| 20434 | 0.002 |
| 20435 | 0.008 |
| 20436 | 0.005 |
| 20437 | 0.004 |
| 20438 | 0.004 |
| 20439 | 0.004 |
| 20440 | 0.005 |
| 20441 | 0.002 |
| 20442 | 0.003 |
| 20443 | 0.003 |
| 20444 | 0.006 |
| 20445 | 0.005 |
| 20446 | 0.003 |
| 20447 | 0.008 |
| 20448 | 0.008 |
| 20449 | 0.002 |
| 20450 | 0.003 |
| 20451 | 0.01 |
| 20452 | 0.009 |
| 20453 | 0.004 |
| 20454 | 0.002 |
| 20455 | 0.007 |
| 20456 | 0.003 |
| 20457 | 0.003 |
| 20458 | 0.003 |
| 20459 | 0.008 |
| 20460 | 0.007 |
| 20461 | 0.003 |
| 20462 | 0.004 |
| 20463 | 0.007 |
| 20464 | 0.005 |
| 20465 | 0.007 |
| 20466 | 0.002 |
| 20467 | 0.003 |
| 20468 | 0.007 |
| 20469 | 0.004 |
| 20470 | 0.002 |
| 20471 | 0.003 |
| 20472 | 0.004 |
| 20473 | 0.003 |
| 20474 | 0.005 |
| 20475 | 0.003 |
| 20476 | 0.003 |
| 20477 | 0.004 |
| 20478 | 0.004 |
| 20479 | 0.004 |
| 20480 | 0.003 |
| 20481 | 0.002 |
| 20482 | 0.001 |
| 20483 | 0.001 |
| 20484 | 0.004 |
| 20485 | 0.002 |
| 20486 | 0.002 |
| 20487 | 0.003 |
| 20488 | 0.006 |
| 20489 | 0.001 |
| 20490 | 0.002 |
| 20491 | 0.003 |
| 20492 | 0.003 |
| 20493 | 0.003 |
| 20494 | 0.005 |
| 20495 | 0.004 |
| 20496 | 0.004 |
| 20497 | 0.004 |
| 20498 | 0.003 |
| 20499 | 0.003 |
| 20500 | 0.003 |
| 20501 | 0.002 |
| 20502 | 0.002 |
| 20503 | 0.005 |
| 20504 | 0.005 |
| 20505 | 0.003 |
| 20506 | 0.003 |
| 20507 | 0.006 |
| 20508 | 0.003 |
| 20509 | 0.005 |
| 20510 | 0.004 |
| 20511 | 0.003 |
| 20512 | 0.004 |
| 20513 | 0.002 |
| 20514 | 0.004 |
| 20515 | 0.001 |
| 20516 | 0.005 |
| 20517 | 0.001 |
| 20518 | 0.002 |
| 20519 | 0.004 |
| 20520 | 0.006 |
| 20521 | 0.003 |
| 20522 | 0.006 |
| 20523 | 0.01 |
| 20524 | 0.007 |
| 20525 | 0.007 |
| 20526 | 0.005 |
| 20527 | 0.004 |
| 20528 | 0.004 |
| 20529 | 0.001 |
| 20530 | 0.002 |
| 20531 | 0.005 |
| 20532 | 0.003 |
| 20533 | 0.003 |
| 20534 | 0.003 |
| 20535 | 0.004 |
| 20536 | 0.006 |
| 20537 | 0.008 |
| 20538 | 0.007 |
| 20539 | 0.006 |
| 20540 | 0.003 |
| 20541 | 0.002 |
| 20542 | 0.006 |
| 20543 | 0.006 |
| 20544 | 0.004 |
| 20545 | 0.003 |
| 20546 | 0.006 |
| 20547 | 0.003 |
| 20548 | 0.003 |
| 20549 | 0.004 |
| 20550 | 0.005 |
| 20551 | 0.006 |
| 20552 | 0.004 |
| 20553 | 0.004 |
| 20554 | 0.004 |
| 20555 | 0.005 |
| 20556 | 0.005 |
| 20557 | 0.007 |
| 20558 | 0.003 |
| 20559 | 0.002 |
| 20560 | 0.001 |
| 20561 | 0.003 |
| 20562 | 0.004 |
| 20563 | 0.006 |
| 20564 | 0.004 |
| 20565 | 0.002 |
| 20566 | 0.004 |
| 20567 | 0.011 |
| 20568 | 0.015 |
| 20569 | 0.01 |
| 20570 | 0.006 |
| 20571 | 0.001 |
| 20572 | 0.004 |
| 20573 | 0.005 |
| 20574 | 0.01 |
| 20575 | 0.004 |
| 20576 | 0.003 |
| 20577 | 0.002 |
| 20578 | 0.002 |
| 20579 | 0.006 |
| 20580 | 0.005 |
| 20581 | 0.001 |
| 20582 | 0.008 |
| 20583 | 0.002 |
| 20584 | 0.008 |
| 20585 | 0.012 |
| 20586 | 0.005 |
| 20587 | 0.013 |
| 20588 | 0.005 |
| 20589 | 0.01 |
| 20590 | 0.01 |
| 20591 | 0.007 |
| 20592 | 0.003 |
| 20593 | 0.002 |
| 20594 | 0.005 |
| 20595 | 0.003 |
| 20596 | 0.003 |
| 20597 | 0.005 |
| 20598 | 0.003 |
| 20599 | 0.005 |
| 20600 | 0.005 |
| 20601 | 0.006 |
| 20602 | 0.003 |
| 20603 | 0.002 |
| 20604 | 0.002 |
| 20605 | 0.002 |
| 20606 | 0.003 |
| 20607 | 0.007 |
| 20608 | 0.002 |
| 20609 | 0.002 |
| 20610 | 0.002 |
| 20611 | 0.007 |
| 20612 | 0.004 |
| 20613 | 0.002 |
| 20614 | 0.005 |
| 20615 | 0.011 |
| 20616 | 0.009 |
| 20617 | 0.002 |
| 20618 | 0.005 |
| 20619 | 0.007 |
| 20620 | 0.005 |
| 20621 | 0.002 |
| 20622 | 0.003 |
| 20623 | 0.004 |
| 20624 | 0.006 |
| 20625 | 0.002 |
| 20626 | 0.001 |
| 20627 | 0.004 |
| 20628 | 0.002 |
| 20629 | 0.003 |
| 20630 | 0.002 |
| 20631 | 0.003 |
| 20632 | 0.006 |
| 20633 | 0.001 |
| 20634 | 0.002 |
| 20635 | 0.003 |
| 20636 | 0.002 |
| 20637 | 0.003 |
| 20638 | 0.006 |
| 20639 | 0.004 |
| 20640 | 0.005 |
| 20641 | 0.001 |
| 20642 | 0.007 |
| 20643 | 0.004 |
| 20644 | 0.005 |
| 20645 | 0.002 |
| 20646 | 0.002 |
| 20647 | 0.009 |
| 20648 | 0.013 |
| 20649 | 0.002 |
| 20650 | 0.003 |
| 20651 | 0.005 |
| 20652 | 0.005 |
| 20653 | 0.005 |
| 20654 | 0.002 |
| 20655 | 0.006 |
| 20656 | 0.008 |
| 20657 | 0.002 |
| 20658 | 0.003 |
| 20659 | 0.005 |
| 20660 | 0.009 |
| 20661 | 0.001 |
| 20662 | 0.003 |
| 20663 | 0.003 |
| 20664 | 0.004 |
| 20665 | 0.009 |
| 20666 | 0.011 |
| 20667 | 0.002 |
| 20668 | 0.004 |
| 20669 | 0.001 |
| 20670 | 0.003 |
| 20671 | 0.003 |
| 20672 | 0.003 |
| 20673 | 0.002 |
| 20674 | 0.004 |
| 20675 | 0.006 |
| 20676 | 0.007 |
| 20677 | 0.008 |
| 20678 | 0.006 |
| 20679 | 0.003 |
| 20680 | 0.003 |
| 20681 | 0.011 |
| 20682 | 0.004 |
| 20683 | 0.001 |
| 20684 | 0.002 |
| 20685 | 0.007 |
| 20686 | 0.004 |
| 20687 | 0.001 |
| 20688 | 0.003 |
| 20689 | 0.008 |
| 20690 | 0.005 |
| 20691 | 0.004 |
| 20692 | 0.006 |
| 20693 | 0.011 |
| 20694 | 0.004 |
| 20695 | 0.004 |
| 20696 | 0.006 |
| 20697 | 0.003 |
| 20698 | 0.003 |
| 20699 | 0.003 |
| 20700 | 0.003 |
| 20701 | 0.002 |
| 20702 | 0.004 |
| 20703 | 0.01 |
| 20704 | 0.01 |
| 20705 | 0.004 |
| 20706 | 0.002 |
| 20707 | 0.004 |
| 20708 | 0.003 |
| 20709 | 0.002 |
| 20710 | 0.004 |
| 20711 | 0.007 |
| 20712 | 0.006 |
| 20713 | 0.004 |
| 20714 | 0.002 |
| 20715 | 0.005 |
| 20716 | 0.008 |
| 20717 | 0.004 |
| 20718 | 0.005 |
| 20719 | 0.003 |
| 20720 | 0.006 |
| 20721 | 0.003 |
| 20722 | 0.002 |
| 20723 | 0.003 |
| 20724 | 0.004 |
| 20725 | 0.001 |
| 20726 | 0.004 |
| 20727 | 0.004 |
| 20728 | 0.004 |
| 20729 | 0.002 |
| 20730 | 0.004 |
| 20731 | 0.005 |
| 20732 | 0.006 |
| 20733 | 0.002 |
| 20734 | 0.002 |
| 20735 | 0.007 |
| 20736 | 0.008 |
| 20737 | 0.004 |
| 20738 | 0.003 |
| 20739 | 0.002 |
| 20740 | 0.003 |
| 20741 | 0.002 |
| 20742 | 0.003 |
| 20743 | 0.005 |
| 20744 | 0.007 |
| 20745 | 0.003 |
| 20746 | 0.006 |
| 20747 | 0.004 |
| 20748 | 0.004 |
| 20749 | 0.001 |
| 20750 | 0.004 |
| 20751 | 0.007 |
| 20752 | 0.004 |
| 20753 | 0.008 |
| 20754 | 0.005 |
| 20755 | 0.005 |
| 20756 | 0.004 |
| 20757 | 0.008 |
| 20758 | 0.003 |
| 20759 | 0.007 |
| 20760 | 0.003 |
| 20761 | 0.003 |
| 20762 | 0.003 |
| 20763 | 0.003 |
| 20764 | 0.001 |
| 20765 | 0.002 |
| 20766 | 0.002 |
| 20767 | 0.001 |
| 20768 | 0.012 |
| 20769 | 0.004 |
| 20770 | 0.001 |
| 20771 | 0.001 |
| 20772 | 0.005 |
| 20773 | 0.005 |
| 20774 | 0.003 |
| 20775 | 0.001 |
| 20776 | 0.003 |
| 20777 | 0.003 |
| 20778 | 0.002 |
| 20779 | 0.005 |
| 20780 | 0.004 |
| 20781 | 0.003 |
| 20782 | 0.003 |
| 20783 | 0.001 |
| 20784 | 0.001 |
| 20785 | 0.003 |
| 20786 | 0.005 |
| 20787 | 0.004 |
| 20788 | 0.004 |
| 20789 | 0.002 |
| 20790 | 0.002 |
| 20791 | 0.002 |
| 20792 | 0.002 |
| 20793 | 0.002 |
| 20794 | 0.002 |
| 20795 | 0.003 |
| 20796 | 0.001 |
| 20797 | 0.007 |
| 20798 | 0.003 |
| 20799 | 0.002 |
| 20800 | 0.004 |
| 20801 | 0.004 |
| 20802 | 0.001 |
| 20803 | 0.002 |
| 20804 | 0.005 |
| 20805 | 0.009 |
| 20806 | 0.004 |
| 20807 | 0.004 |
| 20808 | 0.002 |
| 20809 | 0.005 |
| 20810 | 0.003 |
| 20811 | 0.003 |
| 20812 | 0.005 |
| 20813 | 0.001 |
| 20814 | 0.005 |
| 20815 | 0.001 |
| 20816 | 0.005 |
| 20817 | 0.003 |
| 20818 | 0.003 |
| 20819 | 0.004 |
| 20820 | 0.002 |
| 20821 | 0.001 |
| 20822 | 0.001 |
| 20823 | 0.003 |
| 20824 | 0.003 |
| 20825 | 0.003 |
| 20826 | 0.004 |
| 20827 | 0.002 |
| 20828 | 0.004 |
| 20829 | 0.005 |
| 20830 | 0.002 |
| 20831 | 0.006 |
| 20832 | 0.002 |
| 20833 | 0.003 |
| 20834 | 0.002 |
| 20835 | 0.011 |
| 20836 | 0.005 |
| 20837 | 0.008 |
| 20838 | 0.004 |
| 20839 | 0.004 |
| 20840 | 0.006 |
| 20841 | 0.002 |
| 20842 | 0.004 |
| 20843 | 0.003 |
| 20844 | 0.008 |
| 20845 | 0.005 |
| 20846 | 0.003 |
| 20847 | 0.002 |
| 20848 | 0.005 |
| 20849 | 0.007 |
| 20850 | 0.001 |
| 20851 | 0.002 |
| 20852 | 0.005 |
| 20853 | 0.003 |
| 20854 | 0.006 |
| 20855 | 0.008 |
| 20856 | 0.004 |
| 20857 | 0.003 |
| 20858 | 0.004 |
| 20859 | 0.003 |
| 20860 | 0.006 |
| 20861 | 0.004 |
| 20862 | 0.011 |
| 20863 | 0.012 |
| 20864 | 0.009 |
| 20865 | 0.003 |
| 20866 | 0.004 |
| 20867 | 0 |
| 20868 | 0.005 |
| 20869 | 0.002 |
| 20870 | 0.003 |
| 20871 | 0.005 |
| 20872 | 0.008 |
| 20873 | 0.004 |
| 20874 | 0.011 |
| 20875 | 0.006 |
| 20876 | 0.008 |
| 20877 | 0.002 |
| 20878 | 0.003 |
| 20879 | 0.005 |
| 20880 | 0.008 |
| 20881 | 0.003 |
| 20882 | 0.002 |
| 20883 | 0.003 |
| 20884 | 0.004 |
| 20885 | 0.006 |
| 20886 | 0.002 |
| 20887 | 0.001 |
| 20888 | 0.003 |
| 20889 | 0.007 |
| 20890 | 0.002 |
| 20891 | 0.002 |
| 20892 | 0.007 |
| 20893 | 0.003 |
| 20894 | 0.002 |
| 20895 | 0.004 |
| 20896 | 0.007 |
| 20897 | 0.004 |
| 20898 | 0.005 |
| 20899 | 0.004 |
| 20900 | 0.003 |
| 20901 | 0.006 |
| 20902 | 0.003 |
| 20903 | 0.005 |
| 20904 | 0.006 |
| 20905 | 0.005 |
| 20906 | 0.003 |
| 20907 | 0.009 |
| 20908 | 0.004 |
| 20909 | 0.006 |
| 20910 | 0.002 |
| 20911 | 0.003 |
| 20912 | 0.006 |
| 20913 | 0.005 |
| 20914 | 0.003 |
| 20915 | 0.001 |
| 20916 | 0.009 |
| 20917 | 0.005 |
| 20918 | 0.002 |
| 20919 | 0.003 |
| 20920 | 0.007 |
| 20921 | 0.008 |
| 20922 | 0.001 |
| 20923 | 0.001 |
| 20924 | 0.002 |
| 20925 | 0.003 |
| 20926 | 0.002 |
| 20927 | 0.004 |
| 20928 | 0.007 |
| 20929 | 0.004 |
| 20930 | 0.001 |
| 20931 | 0.005 |
| 20932 | 0.006 |
| 20933 | 0.007 |
| 20934 | 0 |
| 20935 | 0.002 |
| 20936 | 0.001 |
| 20937 | 0.003 |
| 20938 | 0.002 |
| 20939 | 0.003 |
| 20940 | 0.004 |
| 20941 | 0.005 |
| 20942 | 0.002 |
| 20943 | 0.003 |
| 20944 | 0.002 |
| 20945 | 0.002 |
| 20946 | 0.003 |
| 20947 | 0.002 |
| 20948 | 0.004 |
| 20949 | 0.001 |
| 20950 | 0.002 |
| 20951 | 0.003 |
| 20952 | 0.001 |
| 20953 | 0.008 |
| 20954 | 0.002 |
| 20955 | 0.004 |
| 20956 | 0.004 |
| 20957 | 0.003 |
| 20958 | 0.002 |
| 20959 | 0 |
| 20960 | 0.01 |
| 20961 | 0.006 |
| 20962 | 0.004 |
| 20963 | 0.003 |
| 20964 | 0.004 |
| 20965 | 0.004 |
| 20966 | 0.003 |
| 20967 | 0.005 |
| 20968 | 0.002 |
| 20969 | 0.001 |
| 20970 | 0.004 |
| 20971 | 0.002 |
| 20972 | 0.002 |
| 20973 | 0.003 |
| 20974 | 0.002 |
| 20975 | 0.003 |
| 20976 | 0.005 |
| 20977 | 0.005 |
| 20978 | 0.006 |
| 20979 | 0.005 |
| 20980 | 0.002 |
| 20981 | 0.005 |
| 20982 | 0.003 |
| 20983 | 0.002 |
| 20984 | 0.003 |
| 20985 | 0.008 |
| 20986 | 0.004 |
| 20987 | 0.003 |
| 20988 | 0.007 |
| 20989 | 0.005 |
| 20990 | 0.001 |
| 20991 | 0.002 |
| 20992 | 0.003 |
| 20993 | 0.007 |
| 20994 | 0.004 |
| 20995 | 0.005 |
| 20996 | 0.004 |
| 20997 | 0.002 |
| 20998 | 0.004 |
| 20999 | 0.007 |
| 21000 | 0.007 |
| 21001 | 0.011 |
| 21002 | 0.002 |
| 21003 | 0.001 |
| 21004 | 0.002 |
| 21005 | 0.002 |
| 21006 | 0.004 |
| 21007 | 0.007 |
| 21008 | 0.003 |
| 21009 | 0.004 |
| 21010 | 0.003 |
| 21011 | 0.008 |
| 21012 | 0.002 |
| 21013 | 0.003 |
| 21014 | 0.003 |
| 21015 | 0.001 |
| 21016 | 0.006 |
| 21017 | 0.003 |
| 21018 | 0.002 |
| 21019 | 0.005 |
| 21020 | 0.003 |
| 21021 | 0.003 |
| 21022 | 0.004 |
| 21023 | 0.003 |
| 21024 | 0.006 |
| 21025 | 0.001 |
| 21026 | 0.003 |
| 21027 | 0.003 |
| 21028 | 0.002 |
| 21029 | 0.002 |
| 21030 | 0.001 |
| 21031 | 0.005 |
| 21032 | 0.003 |
| 21033 | 0.002 |
| 21034 | 0.003 |
| 21035 | 0.008 |
| 21036 | 0.005 |
| 21037 | 0.006 |
| 21038 | 0.001 |
| 21039 | 0.002 |
| 21040 | 0.002 |
| 21041 | 0.005 |
| 21042 | 0.001 |
| 21043 | 0.003 |
| 21044 | 0.002 |
| 21045 | 0.005 |
| 21046 | 0.002 |
| 21047 | 0.003 |
| 21048 | 0.006 |
| 21049 | 0.009 |
| 21050 | 0.002 |
| 21051 | 0.003 |
| 21052 | 0.005 |
| 21053 | 0.003 |
| 21054 | 0.004 |
| 21055 | 0.004 |
| 21056 | 0.009 |
| 21057 | 0.004 |
| 21058 | 0.003 |
| 21059 | 0 |
| 21060 | 0.005 |
| 21061 | 0.006 |
| 21062 | 0.002 |
| 21063 | 0.004 |
| 21064 | 0.01 |
| 21065 | 0.01 |
| 21066 | 0.006 |
| 21067 | 0.006 |
| 21068 | 0.003 |
| 21069 | 0.002 |
| 21070 | 0.002 |
| 21071 | 0.002 |
| 21072 | 0.005 |
| 21073 | 0.009 |
| 21074 | 0.002 |
| 21075 | 0.003 |
| 21076 | 0.008 |
| 21077 | 0.008 |
| 21078 | 0.002 |
| 21079 | 0.001 |
| 21080 | 0.004 |
| 21081 | 0.003 |
| 21082 | 0.008 |
| 21083 | 0.009 |
| 21084 | 0.004 |
| 21085 | 0.002 |
| 21086 | 0.005 |
| 21087 | 0.003 |
| 21088 | 0.004 |
| 21089 | 0.006 |
| 21090 | 0.001 |
| 21091 | 0.004 |
| 21092 | 0.004 |
| 21093 | 0.004 |
| 21094 | 0.004 |
| 21095 | 0.005 |
| 21096 | 0.005 |
| 21097 | 0.003 |
| 21098 | 0.003 |
| 21099 | 0.004 |
| 21100 | 0.005 |
| 21101 | 0.005 |
| 21102 | 0.005 |
| 21103 | 0.002 |
| 21104 | 0.003 |
| 21105 | 0.005 |
| 21106 | 0.002 |
| 21107 | 0.005 |
| 21108 | 0.007 |
| 21109 | 0.004 |
| 21110 | 0.002 |
| 21111 | 0.005 |
| 21112 | 0.003 |
| 21113 | 0.002 |
| 21114 | 0.001 |
| 21115 | 0.004 |
| 21116 | 0.003 |
| 21117 | 0.003 |
| 21118 | 0.002 |
| 21119 | 0.004 |
| 21120 | 0.003 |
| 21121 | 0.002 |
| 21122 | 0.004 |
| 21123 | 0.002 |
| 21124 | 0.005 |
| 21125 | 0.002 |
| 21126 | 0.005 |
| 21127 | 0.001 |
| 21128 | 0.003 |
| 21129 | 0.003 |
| 21130 | 0.001 |
| 21131 | 0.003 |
| 21132 | 0.01 |
| 21133 | 0.008 |
| 21134 | 0.007 |
| 21135 | 0.006 |
| 21136 | 0.003 |
| 21137 | 0.003 |
| 21138 | 0 |
| 21139 | 0.001 |
| 21140 | 0.003 |
| 21141 | 0.004 |
| 21142 | 0.004 |
| 21143 | 0.006 |
| 21144 | 0.003 |
| 21145 | 0.005 |
| 21146 | 0.011 |
| 21147 | 0.002 |
| 21148 | 0.006 |
| 21149 | 0.005 |
| 21150 | 0.004 |
| 21151 | 0.005 |
| 21152 | 0.007 |
| 21153 | 0.004 |
| 21154 | 0.003 |
| 21155 | 0.006 |
| 21156 | 0.003 |
| 21157 | 0.006 |
| 21158 | 0.005 |
| 21159 | 0.004 |
| 21160 | 0.002 |
| 21161 | 0.003 |
| 21162 | 0.007 |
| 21163 | 0.003 |
| 21164 | 0.004 |
| 21165 | 0.003 |
| 21166 | 0.002 |
| 21167 | 0.005 |
| 21168 | 0.005 |
| 21169 | 0.004 |
| 21170 | 0.01 |
| 21171 | 0.003 |
| 21172 | 0.004 |
| 21173 | 0.006 |
| 21174 | 0.005 |
| 21175 | 0.004 |
| 21176 | 0.005 |
| 21177 | 0.006 |
| 21178 | 0.003 |
| 21179 | 0.01 |
| 21180 | 0.01 |
| 21181 | 0.006 |
| 21182 | 0.007 |
| 21183 | 0.006 |
| 21184 | 0.006 |
| 21185 | 0.007 |
| 21186 | 0.005 |
| 21187 | 0.003 |
| 21188 | 0.007 |
| 21189 | 0.004 |
| 21190 | 0.003 |
| 21191 | 0.009 |
| 21192 | 0.008 |
| 21193 | 0.003 |
| 21194 | 0.002 |
| 21195 | 0.003 |
| 21196 | 0.002 |
| 21197 | 0.001 |
| 21198 | 0.005 |
| 21199 | 0.006 |
| 21200 | 0.006 |
| 21201 | 0.002 |
| 21202 | 0.001 |
| 21203 | 0.002 |
| 21204 | 0.004 |
| 21205 | 0.003 |
| 21206 | 0.003 |
| 21207 | 0.011 |
| 21208 | 0.003 |
| 21209 | 0.003 |
| 21210 | 0.004 |
| 21211 | 0.002 |
| 21212 | 0.006 |
| 21213 | 0.003 |
| 21214 | 0.003 |
| 21215 | 0.003 |
| 21216 | 0.003 |
| 21217 | 0.001 |
| 21218 | 0.003 |
| 21219 | 0.009 |
| 21220 | 0.003 |
| 21221 | 0.002 |
| 21222 | 0.002 |
| 21223 | 0.004 |
| 21224 | 0.009 |
| 21225 | 0.002 |
| 21226 | 0.002 |
| 21227 | 0.004 |
| 21228 | 0.004 |
| 21229 | 0.003 |
| 21230 | 0.002 |
| 21231 | 0.003 |
| 21232 | 0.007 |
| 21233 | 0.003 |
| 21234 | 0.003 |
| 21235 | 0.002 |
| 21236 | 0.002 |
| 21237 | 0.006 |
| 21238 | 0.006 |
| 21239 | 0.011 |
| 21240 | 0.006 |
| 21241 | 0.005 |
| 21242 | 0.006 |
| 21243 | 0.007 |
| 21244 | 0.008 |
| 21245 | 0.002 |
| 21246 | 0.001 |
| 21247 | 0.004 |
| 21248 | 0.004 |
| 21249 | 0.003 |
| 21250 | 0.003 |
| 21251 | 0.005 |
| 21252 | 0.006 |
| 21253 | 0.003 |
| 21254 | 0.004 |
| 21255 | 0.006 |
| 21256 | 0.007 |
| 21257 | 0.002 |
| 21258 | 0.004 |
| 21259 | 0.004 |
| 21260 | 0.003 |
| 21261 | 0.004 |
| 21262 | 0.003 |
| 21263 | 0.005 |
| 21264 | 0.002 |
| 21265 | 0.003 |
| 21266 | 0.002 |
| 21267 | 0.003 |
| 21268 | 0.004 |
| 21269 | 0.001 |
| 21270 | 0.001 |
| 21271 | 0.006 |
| 21272 | 0.003 |
| 21273 | 0.003 |
| 21274 | 0.003 |
| 21275 | 0.005 |
| 21276 | 0.003 |
| 21277 | 0.001 |
| 21278 | 0.004 |
| 21279 | 0.004 |
| 21280 | 0 |
| 21281 | 0.004 |
| 21282 | 0.003 |
| 21283 | 0.006 |
| 21284 | 0.008 |
| 21285 | 0.004 |
| 21286 | 0.009 |
| 21287 | 0.004 |
| 21288 | 0.005 |
| 21289 | 0.002 |
| 21290 | 0.003 |
| 21291 | 0.006 |
| 21292 | 0.008 |
| 21293 | 0.004 |
| 21294 | 0.006 |
| 21295 | 0.006 |
| 21296 | 0.004 |
| 21297 | 0.001 |
| 21298 | 0.003 |
| 21299 | 0.004 |
| 21300 | 0.002 |
| 21301 | 0.002 |
| 21302 | 0.003 |
| 21303 | 0.004 |
| 21304 | 0.007 |
| 21305 | 0.004 |
| 21306 | 0.001 |
| 21307 | 0.007 |
| 21308 | 0.005 |
| 21309 | 0.004 |
| 21310 | 0.004 |
| 21311 | 0.01 |
| 21312 | 0.007 |
| 21313 | 0.004 |
| 21314 | 0.002 |
| 21315 | 0.002 |
| 21316 | 0.007 |
| 21317 | 0.003 |
| 21318 | 0.002 |
| 21319 | 0.002 |
| 21320 | 0.002 |
| 21321 | 0.002 |
| 21322 | 0.002 |
| 21323 | 0.002 |
| 21324 | 0.005 |
| 21325 | 0.005 |
| 21326 | 0.001 |
| 21327 | 0.001 |
| 21328 | 0.006 |
| 21329 | 0.007 |
| 21330 | 0.002 |
| 21331 | 0.001 |
| 21332 | 0.008 |
| 21333 | 0.003 |
| 21334 | 0.004 |
| 21335 | 0.002 |
| 21336 | 0.004 |
| 21337 | 0.004 |
| 21338 | 0.002 |
| 21339 | 0.002 |
| 21340 | 0.004 |
| 21341 | 0.004 |
| 21342 | 0.005 |
| 21343 | 0.006 |
| 21344 | 0.005 |
| 21345 | 0.007 |
| 21346 | 0.005 |
| 21347 | 0.006 |
| 21348 | 0.006 |
| 21349 | 0.009 |
| 21350 | 0.003 |
| 21351 | 0.002 |
| 21352 | 0.004 |
| 21353 | 0.006 |
| 21354 | 0.005 |
| 21355 | 0.002 |
| 21356 | 0.003 |
| 21357 | 0.006 |
| 21358 | 0.003 |
| 21359 | 0.002 |
| 21360 | 0.01 |
| 21361 | 0.007 |
| 21362 | 0.002 |
| 21363 | 0.003 |
| 21364 | 0.003 |
| 21365 | 0.003 |
| 21366 | 0.003 |
| 21367 | 0.003 |
| 21368 | 0.003 |
| 21369 | 0.003 |
| 21370 | 0.004 |
| 21371 | 0.005 |
| 21372 | 0.006 |
| 21373 | 0.005 |
| 21374 | 0.006 |
| 21375 | 0.005 |
| 21376 | 0.008 |
| 21377 | 0.005 |
| 21378 | 0.003 |
| 21379 | 0.002 |
| 21380 | 0.004 |
| 21381 | 0.003 |
| 21382 | 0.004 |
| 21383 | 0.008 |
| 21384 | 0.007 |
| 21385 | 0.002 |
| 21386 | 0.002 |
| 21387 | 0.003 |
| 21388 | 0.002 |
| 21389 | 0.009 |
| 21390 | 0.001 |
| 21391 | 0.004 |
| 21392 | 0.004 |
| 21393 | 0.013 |
| 21394 | 0.006 |
| 21395 | 0.004 |
| 21396 | 0.005 |
| 21397 | 0.005 |
| 21398 | 0.005 |
| 21399 | 0.007 |
| 21400 | 0.004 |
| 21401 | 0.012 |
| 21402 | 0.007 |
| 21403 | 0.002 |
| 21404 | 0.006 |
| 21405 | 0.008 |
| 21406 | 0.002 |
| 21407 | 0.002 |
| 21408 | 0.007 |
| 21409 | 0.002 |
| 21410 | 0.006 |
| 21411 | 0.004 |
| 21412 | 0.002 |
| 21413 | 0.006 |
| 21414 | 0.008 |
| 21415 | 0.003 |
| 21416 | 0.007 |
| 21417 | 0.001 |
| 21418 | 0.002 |
| 21419 | 0.005 |
| 21420 | 0.004 |
| 21421 | 0.009 |
| 21422 | 0.003 |
| 21423 | 0.004 |
| 21424 | 0.003 |
| 21425 | 0.004 |
| 21426 | 0.004 |
| 21427 | 0.007 |
| 21428 | 0.006 |
| 21429 | 0.006 |
| 21430 | 0.005 |
| 21431 | 0.006 |
| 21432 | 0.004 |
| 21433 | 0.002 |
| 21434 | 0.001 |
| 21435 | 0.006 |
| 21436 | 0.005 |
| 21437 | 0.006 |
| 21438 | 0.007 |
| 21439 | 0.009 |
| 21440 | 0.005 |
| 21441 | 0.003 |
| 21442 | 0.006 |
| 21443 | 0.003 |
| 21444 | 0.006 |
| 21445 | 0.005 |
| 21446 | 0.005 |
| 21447 | 0.008 |
| 21448 | 0.009 |
| 21449 | 0.001 |
| 21450 | 0.004 |
| 21451 | 0.007 |
| 21452 | 0.007 |
| 21453 | 0.005 |
| 21454 | 0.004 |
| 21455 | 0.01 |
| 21456 | 0.007 |
| 21457 | 0.008 |
| 21458 | 0.007 |
| 21459 | 0.006 |
| 21460 | 0.005 |
| 21461 | 0.004 |
| 21462 | 0.006 |
| 21463 | 0.008 |
| 21464 | 0.014 |
| 21465 | 0.015 |
| 21466 | 0.013 |
| 21467 | 0.007 |
| 21468 | 0.005 |
| 21469 | 0.008 |
| 21470 | 0.011 |
| 21471 | 0.005 |
| 21472 | 0.005 |
| 21473 | 0.007 |
| 21474 | 0.003 |
| 21475 | 0.003 |
| 21476 | 0.002 |
| 21477 | 0.002 |
| 21478 | 0.006 |
| 21479 | 0.001 |
| 21480 | 0.006 |
| 21481 | 0.004 |
| 21482 | 0.005 |
| 21483 | 0.003 |
| 21484 | 0.006 |
| 21485 | 0.004 |
| 21486 | 0.002 |
| 21487 | 0.003 |
| 21488 | 0.004 |
| 21489 | 0.002 |
| 21490 | 0.003 |
| 21491 | 0.003 |
| 21492 | 0.004 |
| 21493 | 0.008 |
| 21494 | 0.003 |
| 21495 | 0.006 |
| 21496 | 0.003 |
| 21497 | 0.004 |
| 21498 | 0.005 |
| 21499 | 0.004 |
| 21500 | 0.002 |
| 21501 | 0.009 |
| 21502 | 0.003 |
| 21503 | 0.002 |
| 21504 | 0.004 |
| 21505 | 0.004 |
| 21506 | 0.002 |
| 21507 | 0.003 |
| 21508 | 0.005 |
| 21509 | 0.002 |
| 21510 | 0.001 |
| 21511 | 0.003 |
| 21512 | 0.005 |
| 21513 | 0.012 |
| 21514 | 0.001 |
| 21515 | 0.004 |
| 21516 | 0.007 |
| 21517 | 0.009 |
| 21518 | 0.002 |
| 21519 | 0.005 |
| 21520 | 0.002 |
| 21521 | 0.004 |
| 21522 | 0.003 |
| 21523 | 0.004 |
| 21524 | 0.006 |
| 21525 | 0.006 |
| 21526 | 0.004 |
| 21527 | 0.003 |
| 21528 | 0.006 |
| 21529 | 0.002 |
| 21530 | 0.002 |
| 21531 | 0.002 |
| 21532 | 0.003 |
| 21533 | 0.002 |
| 21534 | 0.003 |
| 21535 | 0.002 |
| 21536 | 0.005 |
| 21537 | 0.012 |
| 21538 | 0.002 |
| 21539 | 0.003 |
| 21540 | 0.003 |
| 21541 | 0.012 |
| 21542 | 0.002 |
| 21543 | 0.002 |
| 21544 | 0.002 |
| 21545 | 0.003 |
| 21546 | 0.002 |
| 21547 | 0.006 |
| 21548 | 0.003 |
| 21549 | 0.004 |
| 21550 | 0.003 |
| 21551 | 0.001 |
| 21552 | 0.001 |
| 21553 | 0.004 |
| 21554 | 0.004 |
| 21555 | 0.003 |
| 21556 | 0.007 |
| 21557 | 0.007 |
| 21558 | 0.004 |
| 21559 | 0.005 |
| 21560 | 0.005 |
| 21561 | 0.006 |
| 21562 | 0.001 |
| 21563 | 0.004 |
| 21564 | 0.004 |
| 21565 | 0.004 |
| 21566 | 0.006 |
| 21567 | 0.002 |
| 21568 | 0.004 |
| 21569 | 0.003 |
| 21570 | 0.003 |
| 21571 | 0.003 |
| 21572 | 0.002 |
| 21573 | 0.005 |
| 21574 | 0.002 |
| 21575 | 0.003 |
| 21576 | 0.004 |
| 21577 | 0.001 |
| 21578 | 0.007 |
| 21579 | 0.007 |
| 21580 | 0.009 |
| 21581 | 0.004 |
| 21582 | 0.003 |
| 21583 | 0.002 |
| 21584 | 0.001 |
| 21585 | 0.005 |
| 21586 | 0.004 |
| 21587 | 0.004 |
| 21588 | 0.006 |
| 21589 | 0.004 |
| 21590 | 0.005 |
| 21591 | 0.005 |
| 21592 | 0.004 |
| 21593 | 0.004 |
| 21594 | 0.001 |
| 21595 | 0.006 |
| 21596 | 0.006 |
| 21597 | 0.002 |
| 21598 | 0.005 |
| 21599 | 0.004 |
| 21600 | 0.006 |
| 21601 | 0.004 |
| 21602 | 0.003 |
| 21603 | 0.004 |
| 21604 | 0.005 |
| 21605 | 0.012 |
| 21606 | 0.002 |
| 21607 | 0.006 |
| 21608 | 0.006 |
| 21609 | 0.003 |
| 21610 | 0.002 |
| 21611 | 0.011 |
| 21612 | 0.005 |
| 21613 | 0 |
| 21614 | 0.004 |
| 21615 | 0.005 |
| 21616 | 0.007 |
| 21617 | 0.003 |
| 21618 | 0.004 |
| 21619 | 0.004 |
| 21620 | 0.009 |
| 21621 | 0.002 |
| 21622 | 0.005 |
| 21623 | 0.007 |
| 21624 | 0.005 |
| 21625 | 0.002 |
| 21626 | 0.002 |
| 21627 | 0.002 |
| 21628 | 0.004 |
| 21629 | 0.003 |
| 21630 | 0.002 |
| 21631 | 0.003 |
| 21632 | 0.002 |
| 21633 | 0.003 |
| 21634 | 0.003 |
| 21635 | 0.005 |
| 21636 | 0.004 |
| 21637 | 0.007 |
| 21638 | 0.015 |
| 21639 | 0.012 |
| 21640 | 0.006 |
| 21641 | 0.004 |
| 21642 | 0.003 |
| 21643 | 0.002 |
| 21644 | 0.007 |
| 21645 | 0.003 |
| 21646 | 0.004 |
| 21647 | 0.005 |
| 21648 | 0.006 |
| 21649 | 0.004 |
| 21650 | 0.007 |
| 21651 | 0.006 |
| 21652 | 0.001 |
| 21653 | 0.002 |
| 21654 | 0.007 |
| 21655 | 0.004 |
| 21656 | 0.003 |
| 21657 | 0.002 |
| 21658 | 0.002 |
| 21659 | 0.012 |
| 21660 | 0.006 |
| 21661 | 0.002 |
| 21662 | 0.001 |
| 21663 | 0.008 |
| 21664 | 0.009 |
| 21665 | 0.009 |
| 21666 | 0.007 |
| 21667 | 0.007 |
| 21668 | 0.005 |
| 21669 | 0.001 |
| 21670 | 0.002 |
| 21671 | 0.002 |
| 21672 | 0.003 |
| 21673 | 0.001 |
| 21674 | 0.005 |
| 21675 | 0.003 |
| 21676 | 0.008 |
| 21677 | 0.003 |
| 21678 | 0.004 |
| 21679 | 0.002 |
| 21680 | 0.011 |
| 21681 | 0.005 |
| 21682 | 0.004 |
| 21683 | 0.002 |
| 21684 | 0.006 |
| 21685 | 0.003 |
| 21686 | 0.002 |
| 21687 | 0.012 |
| 21688 | 0.001 |
| 21689 | 0.004 |
| 21690 | 0.001 |
| 21691 | 0.001 |
| 21692 | 0.001 |
| 21693 | 0.002 |
| 21694 | 0.003 |
| 21695 | 0.005 |
| 21696 | 0.008 |
| 21697 | 0.004 |
| 21698 | 0.003 |
| 21699 | 0.004 |
| 21700 | 0.006 |
| 21701 | 0.008 |
| 21702 | 0.001 |
| 21703 | 0.001 |
| 21704 | 0.003 |
| 21705 | 0.003 |
| 21706 | 0.002 |
| 21707 | 0.003 |
| 21708 | 0.001 |
| 21709 | 0.001 |
| 21710 | 0.003 |
| 21711 | 0.001 |
| 21712 | 0.006 |
| 21713 | 0.002 |
| 21714 | 0.002 |
| 21715 | 0.005 |
| 21716 | 0.004 |
| 21717 | 0.002 |
| 21718 | 0.004 |
| 21719 | 0.003 |
| 21720 | 0.005 |
| 21721 | 0.001 |
| 21722 | 0.006 |
| 21723 | 0.004 |
| 21724 | 0.005 |
| 21725 | 0.006 |
| 21726 | 0.001 |
| 21727 | 0.001 |
| 21728 | 0.005 |
| 21729 | 0.003 |
| 21730 | 0.007 |
| 21731 | 0.004 |
| 21732 | 0.005 |
| 21733 | 0.007 |
| 21734 | 0.005 |
| 21735 | 0.004 |
| 21736 | 0.004 |
| 21737 | 0.006 |
| 21738 | 0.004 |
| 21739 | 0.003 |
| 21740 | 0.005 |
| 21741 | 0.004 |
| 21742 | 0.005 |
| 21743 | 0.004 |
| 21744 | 0.003 |
| 21745 | 0.006 |
| 21746 | 0.003 |
| 21747 | 0.002 |
| 21748 | 0.002 |
| 21749 | 0.004 |
| 21750 | 0.009 |
| 21751 | 0.006 |
| 21752 | 0.008 |
| 21753 | 0.003 |
| 21754 | 0.007 |
| 21755 | 0.003 |
| 21756 | 0.007 |
| 21757 | 0.005 |
| 21758 | 0.003 |
| 21759 | 0.003 |
| 21760 | 0.003 |
| 21761 | 0.002 |
| 21762 | 0.005 |
| 21763 | 0.003 |
| 21764 | 0.005 |
| 21765 | 0.005 |
| 21766 | 0.004 |
| 21767 | 0.002 |
| 21768 | 0.003 |
| 21769 | 0.007 |
| 21770 | 0.004 |
| 21771 | 0.003 |
| 21772 | 0.007 |
| 21773 | 0.007 |
| 21774 | 0.01 |
| 21775 | 0.005 |
| 21776 | 0.004 |
| 21777 | 0.002 |
| 21778 | 0.003 |
| 21779 | 0.008 |
| 21780 | 0.004 |
| 21781 | 0.004 |
| 21782 | 0.008 |
| 21783 | 0.008 |
| 21784 | 0.008 |
| 21785 | 0.003 |
| 21786 | 0.002 |
| 21787 | 0.005 |
| 21788 | 0.006 |
| 21789 | 0.003 |
| 21790 | 0.001 |
| 21791 | 0.007 |
| 21792 | 0.006 |
| 21793 | 0.003 |
| 21794 | 0.002 |
| 21795 | 0.001 |
| 21796 | 0.003 |
| 21797 | 0.002 |
| 21798 | 0.001 |
| 21799 | 0.006 |
| 21800 | 0.001 |
| 21801 | 0.003 |
| 21802 | 0.002 |
| 21803 | 0.003 |
| 21804 | 0.005 |
| 21805 | 0.005 |
| 21806 | 0.003 |
| 21807 | 0.003 |
| 21808 | 0.004 |
| 21809 | 0.003 |
| 21810 | 0.002 |
| 21811 | 0.005 |
| 21812 | 0.005 |
| 21813 | 0.004 |
| 21814 | 0.002 |
| 21815 | 0.006 |
| 21816 | 0.006 |
| 21817 | 0.003 |
| 21818 | 0.001 |
| 21819 | 0.004 |
| 21820 | 0.01 |
| 21821 | 0.001 |
| 21822 | 0.004 |
| 21823 | 0.003 |
| 21824 | 0.004 |
| 21825 | 0.004 |
| 21826 | 0.004 |
| 21827 | 0.004 |
| 21828 | 0.003 |
| 21829 | 0.004 |
| 21830 | 0.003 |
| 21831 | 0.003 |
| 21832 | 0.006 |
| 21833 | 0.001 |
| 21834 | 0.003 |
| 21835 | 0.004 |
| 21836 | 0.002 |
| 21837 | 0.002 |
| 21838 | 0.005 |
| 21839 | 0.003 |
| 21840 | 0.005 |
| 21841 | 0.002 |
| 21842 | 0.002 |
| 21843 | 0.008 |
| 21844 | 0.006 |
| 21845 | 0.003 |
| 21846 | 0.003 |
| 21847 | 0.007 |
| 21848 | 0.008 |
| 21849 | 0.004 |
| 21850 | 0 |
| 21851 | 0.007 |
| 21852 | 0.006 |
| 21853 | 0.002 |
| 21854 | 0.003 |
| 21855 | 0.002 |
| 21856 | 0.004 |
| 21857 | 0.002 |
| 21858 | 0.002 |
| 21859 | 0.005 |
| 21860 | 0.003 |
| 21861 | 0.001 |
| 21862 | 0.001 |
| 21863 | 0.008 |
| 21864 | 0.004 |
| 21865 | 0.002 |
| 21866 | 0.005 |
| 21867 | 0.009 |
| 21868 | 0.005 |
| 21869 | 0.004 |
| 21870 | 0.003 |
| 21871 | 0.004 |
| 21872 | 0.004 |
| 21873 | 0.006 |
| 21874 | 0.003 |
| 21875 | 0.002 |
| 21876 | 0.003 |
| 21877 | 0.002 |
| 21878 | 0.001 |
| 21879 | 0.004 |
| 21880 | 0.003 |
| 21881 | 0.002 |
| 21882 | 0.001 |
| 21883 | 0.006 |
| 21884 | 0.005 |
| 21885 | 0.002 |
| 21886 | 0.005 |
| 21887 | 0.004 |
| 21888 | 0.004 |
| 21889 | 0.006 |
| 21890 | 0.008 |
| 21891 | 0.005 |
| 21892 | 0.004 |
| 21893 | 0.004 |
| 21894 | 0.001 |
| 21895 | 0.001 |
| 21896 | 0.003 |
| 21897 | 0.002 |
| 21898 | 0.006 |
| 21899 | 0.005 |
| 21900 | 0.003 |
| 21901 | 0.002 |
| 21902 | 0.003 |
| 21903 | 0.008 |
| 21904 | 0.007 |
| 21905 | 0.001 |
| 21906 | 0.003 |
| 21907 | 0.006 |
| 21908 | 0.006 |
| 21909 | 0.003 |
| 21910 | 0.005 |
| 21911 | 0.006 |
| 21912 | 0.006 |
| 21913 | 0.004 |
| 21914 | 0.002 |
| 21915 | 0.003 |
| 21916 | 0.006 |
| 21917 | 0.004 |
| 21918 | 0.004 |
| 21919 | 0.006 |
| 21920 | 0.008 |
| 21921 | 0.002 |
| 21922 | 0.006 |
| 21923 | 0.004 |
| 21924 | 0.007 |
| 21925 | 0.007 |
| 21926 | 0.004 |
| 21927 | 0.003 |
| 21928 | 0.003 |
| 21929 | 0.002 |
| 21930 | 0.005 |
| 21931 | 0.004 |
| 21932 | 0.005 |
| 21933 | 0.005 |
| 21934 | 0.004 |
| 21935 | 0.005 |
| 21936 | 0.003 |
| 21937 | 0.001 |
| 21938 | 0.002 |
| 21939 | 0.007 |
| 21940 | 0.005 |
| 21941 | 0.001 |
| 21942 | 0.001 |
| 21943 | 0.004 |
| 21944 | 0.006 |
| 21945 | 0.004 |
| 21946 | 0.004 |
| 21947 | 0.007 |
| 21948 | 0.002 |
| 21949 | 0.003 |
| 21950 | 0.002 |
| 21951 | 0.003 |
| 21952 | 0.004 |
| 21953 | 0.003 |
| 21954 | 0.006 |
| 21955 | 0.003 |
| 21956 | 0 |
| 21957 | 0.001 |
| 21958 | 0.002 |
| 21959 | 0.004 |
| 21960 | 0.003 |
| 21961 | 0.004 |
| 21962 | 0.004 |
| 21963 | 0.005 |
| 21964 | 0.003 |
| 21965 | 0.002 |
| 21966 | 0.001 |
| 21967 | 0.003 |
| 21968 | 0.004 |
| 21969 | 0.004 |
| 21970 | 0.006 |
| 21971 | 0.004 |
| 21972 | 0.014 |
| 21973 | 0.004 |
| 21974 | 0.003 |
| 21975 | 0.004 |
| 21976 | 0.006 |
| 21977 | 0.01 |
| 21978 | 0.002 |
| 21979 | 0.003 |
| 21980 | 0.002 |
| 21981 | 0.006 |
| 21982 | 0.003 |
| 21983 | 0.001 |
| 21984 | 0.002 |
| 21985 | 0.007 |
| 21986 | 0.001 |
| 21987 | 0.007 |
| 21988 | 0.006 |
| 21989 | 0.004 |
| 21990 | 0.004 |
| 21991 | 0.002 |
| 21992 | 0.002 |
| 21993 | 0.006 |
| 21994 | 0.003 |
| 21995 | 0.004 |
| 21996 | 0.002 |
| 21997 | 0.005 |
| 21998 | 0.001 |
| 21999 | 0.004 |
| 22000 | 0.002 |
| 22001 | 0.001 |
| 22002 | 0.004 |
| 22003 | 0.005 |
| 22004 | 0.001 |
| 22005 | 0.006 |
| 22006 | 0.004 |
| 22007 | 0.003 |
| 22008 | 0.003 |
| 22009 | 0.002 |
| 22010 | 0.005 |
| 22011 | 0.004 |
| 22012 | 0.007 |
| 22013 | 0.004 |
| 22014 | 0.004 |
| 22015 | 0.002 |
| 22016 | 0.01 |
| 22017 | 0.002 |
| 22018 | 0.006 |
| 22019 | 0.002 |
| 22020 | 0.006 |
| 22021 | 0.008 |
| 22022 | 0.002 |
| 22023 | 0.009 |
| 22024 | 0.002 |
| 22025 | 0.002 |
| 22026 | 0.003 |
| 22027 | 0.004 |
| 22028 | 0.002 |
| 22029 | 0.003 |
| 22030 | 0.003 |
| 22031 | 0.006 |
| 22032 | 0.007 |
| 22033 | 0.008 |
| 22034 | 0.008 |
| 22035 | 0.008 |
| 22036 | 0.006 |
| 22037 | 0.006 |
| 22038 | 0.007 |
| 22039 | 0.003 |
| 22040 | 0.001 |
| 22041 | 0.005 |
| 22042 | 0.003 |
| 22043 | 0.004 |
| 22044 | 0.006 |
| 22045 | 0.002 |
| 22046 | 0.004 |
| 22047 | 0.004 |
| 22048 | 0.003 |
| 22049 | 0.003 |
| 22050 | 0.01 |
| 22051 | 0.005 |
| 22052 | 0.01 |
| 22053 | 0.005 |
| 22054 | 0.005 |
| 22055 | 0.004 |
| 22056 | 0.006 |
| 22057 | 0.005 |
| 22058 | 0.005 |
| 22059 | 0.003 |
| 22060 | 0.005 |
| 22061 | 0.006 |
| 22062 | 0.004 |
| 22063 | 0.002 |
| 22064 | 0.004 |
| 22065 | 0.003 |
| 22066 | 0.006 |
| 22067 | 0.007 |
| 22068 | 0.005 |
| 22069 | 0.008 |
| 22070 | 0.002 |
| 22071 | 0.003 |
| 22072 | 0.003 |
| 22073 | 0.002 |
| 22074 | 0 |
| 22075 | 0.007 |
| 22076 | 0.007 |
| 22077 | 0.003 |
| 22078 | 0.004 |
| 22079 | 0.008 |
| 22080 | 0.008 |
| 22081 | 0.003 |
| 22082 | 0.001 |
| 22083 | 0.008 |
| 22084 | 0.004 |
| 22085 | 0.001 |
| 22086 | 0.003 |
| 22087 | 0.002 |
| 22088 | 0.005 |
| 22089 | 0.003 |
| 22090 | 0.003 |
| 22091 | 0.002 |
| 22092 | 0.008 |
| 22093 | 0.004 |
| 22094 | 0.003 |
| 22095 | 0.004 |
| 22096 | 0.003 |
| 22097 | 0.007 |
| 22098 | 0.002 |
| 22099 | 0.001 |
| 22100 | 0.004 |
| 22101 | 0.006 |
| 22102 | 0.001 |
| 22103 | 0.004 |
| 22104 | 0.006 |
| 22105 | 0.005 |
| 22106 | 0.002 |
| 22107 | 0.003 |
| 22108 | 0.004 |
| 22109 | 0.005 |
| 22110 | 0.001 |
| 22111 | 0.005 |
| 22112 | 0.004 |
| 22113 | 0.006 |
| 22114 | 0.002 |
| 22115 | 0.011 |
| 22116 | 0.01 |
| 22117 | 0.011 |
| 22118 | 0.003 |
| 22119 | 0.003 |
| 22120 | 0.003 |
| 22121 | 0.005 |
| 22122 | 0.005 |
| 22123 | 0.002 |
| 22124 | 0.004 |
| 22125 | 0.001 |
| 22126 | 0.001 |
| 22127 | 0.004 |
| 22128 | 0.006 |
| 22129 | 0.004 |
| 22130 | 0.002 |
| 22131 | 0.006 |
| 22132 | 0.007 |
| 22133 | 0.004 |
| 22134 | 0.002 |
| 22135 | 0.004 |
| 22136 | 0.005 |
| 22137 | 0.006 |
| 22138 | 0.003 |
| 22139 | 0.002 |
| 22140 | 0.002 |
| 22141 | 0.003 |
| 22142 | 0.003 |
| 22143 | 0.003 |
| 22144 | 0.003 |
| 22145 | 0.006 |
| 22146 | 0.002 |
| 22147 | 0.002 |
| 22148 | 0.008 |
| 22149 | 0.003 |
| 22150 | 0.003 |
| 22151 | 0.005 |
| 22152 | 0.006 |
| 22153 | 0.008 |
| 22154 | 0.002 |
| 22155 | 0.005 |
| 22156 | 0.008 |
| 22157 | 0.003 |
| 22158 | 0.003 |
| 22159 | 0.002 |
| 22160 | 0.002 |
| 22161 | 0.002 |
| 22162 | 0.002 |
| 22163 | 0.004 |
| 22164 | 0.007 |
| 22165 | 0.003 |
| 22166 | 0.002 |
| 22167 | 0.003 |
| 22168 | 0.004 |
| 22169 | 0.008 |
| 22170 | 0.004 |
| 22171 | 0.006 |
| 22172 | 0.002 |
| 22173 | 0.008 |
| 22174 | 0.002 |
| 22175 | 0.004 |
| 22176 | 0.009 |
| 22177 | 0.006 |
| 22178 | 0.002 |
| 22179 | 0.006 |
| 22180 | 0.005 |
| 22181 | 0.006 |
| 22182 | 0.003 |
| 22183 | 0.003 |
| 22184 | 0.002 |
| 22185 | 0.006 |
| 22186 | 0.002 |
| 22187 | 0.005 |
| 22188 | 0.01 |
| 22189 | 0.011 |
| 22190 | 0.001 |
| 22191 | 0.003 |
| 22192 | 0.004 |
| 22193 | 0.006 |
| 22194 | 0.002 |
| 22195 | 0.003 |
| 22196 | 0.003 |
| 22197 | 0.004 |
| 22198 | 0.001 |
| 22199 | 0.003 |
| 22200 | 0.002 |
| 22201 | 0.006 |
| 22202 | 0.001 |
| 22203 | 0.004 |
| 22204 | 0.005 |
| 22205 | 0.005 |
| 22206 | 0.002 |
| 22207 | 0.002 |
| 22208 | 0.002 |
| 22209 | 0.001 |
| 22210 | 0.003 |
| 22211 | 0.001 |
| 22212 | 0.003 |
| 22213 | 0.009 |
| 22214 | 0.004 |
| 22215 | 0.002 |
| 22216 | 0.005 |
| 22217 | 0.006 |
| 22218 | 0.001 |
| 22219 | 0.002 |
| 22220 | 0.007 |
| 22221 | 0.004 |
| 22222 | 0.002 |
| 22223 | 0.003 |
| 22224 | 0.009 |
| 22225 | 0.007 |
| 22226 | 0.003 |
| 22227 | 0.003 |
| 22228 | 0.002 |
| 22229 | 0.002 |
| 22230 | 0.003 |
| 22231 | 0.004 |
| 22232 | 0.002 |
| 22233 | 0.005 |
| 22234 | 0.001 |
| 22235 | 0.003 |
| 22236 | 0.004 |
| 22237 | 0.006 |
| 22238 | 0.005 |
| 22239 | 0.005 |
| 22240 | 0.006 |
| 22241 | 0.002 |
| 22242 | 0.005 |
| 22243 | 0.003 |
| 22244 | 0.006 |
| 22245 | 0.002 |
| 22246 | 0.003 |
| 22247 | 0.009 |
| 22248 | 0.009 |
| 22249 | 0.002 |
| 22250 | 0.003 |
| 22251 | 0.01 |
| 22252 | 0.003 |
| 22253 | 0.003 |
| 22254 | 0.004 |
| 22255 | 0.002 |
| 22256 | 0.003 |
| 22257 | 0.002 |
| 22258 | 0.001 |
| 22259 | 0.005 |
| 22260 | 0.005 |
| 22261 | 0.002 |
| 22262 | 0.002 |
| 22263 | 0.005 |
| 22264 | 0.004 |
| 22265 | 0.004 |
| 22266 | 0.002 |
| 22267 | 0.003 |
| 22268 | 0.003 |
| 22269 | 0.003 |
| 22270 | 0.002 |
| 22271 | 0.004 |
| 22272 | 0.004 |
| 22273 | 0.002 |
| 22274 | 0.007 |
| 22275 | 0.004 |
| 22276 | 0.005 |
| 22277 | 0.003 |
| 22278 | 0.004 |
| 22279 | 0.003 |
| 22280 | 0.004 |
| 22281 | 0.004 |
| 22282 | 0.003 |
| 22283 | 0.01 |
| 22284 | 0.004 |
| 22285 | 0.007 |
| 22286 | 0.003 |
| 22287 | 0.004 |
| 22288 | 0.007 |
| 22289 | 0.004 |
| 22290 | 0.002 |
| 22291 | 0.003 |
| 22292 | 0.006 |
| 22293 | 0.003 |
| 22294 | 0.005 |
| 22295 | 0.001 |
| 22296 | 0.004 |
| 22297 | 0.006 |
| 22298 | 0.002 |
| 22299 | 0.002 |
| 22300 | 0.002 |
| 22301 | 0.003 |
| 22302 | 0.005 |
| 22303 | 0.002 |
| 22304 | 0.002 |
| 22305 | 0.002 |
| 22306 | 0.009 |
| 22307 | 0.005 |
| 22308 | 0.001 |
| 22309 | 0.005 |
| 22310 | 0.002 |
| 22311 | 0.002 |
| 22312 | 0.004 |
| 22313 | 0.002 |
| 22314 | 0.003 |
| 22315 | 0.002 |
| 22316 | 0.003 |
| 22317 | 0.003 |
| 22318 | 0.005 |
| 22319 | 0.005 |
| 22320 | 0.006 |
| 22321 | 0.006 |
| 22322 | 0.004 |
| 22323 | 0.006 |
| 22324 | 0.003 |
| 22325 | 0.003 |
| 22326 | 0.01 |
| 22327 | 0.012 |
| 22328 | 0.003 |
| 22329 | 0.004 |
| 22330 | 0.006 |
| 22331 | 0.005 |
| 22332 | 0.003 |
| 22333 | 0.006 |
| 22334 | 0.005 |
| 22335 | 0.004 |
| 22336 | 0.007 |
| 22337 | 0.003 |
| 22338 | 0.002 |
| 22339 | 0.004 |
| 22340 | 0.002 |
| 22341 | 0.001 |
| 22342 | 0.003 |
| 22343 | 0.009 |
| 22344 | 0.007 |
| 22345 | 0.001 |
| 22346 | 0.003 |
| 22347 | 0.004 |
| 22348 | 0.004 |
| 22349 | 0.007 |
| 22350 | 0.008 |
| 22351 | 0.007 |
| 22352 | 0.013 |
| 22353 | 0.004 |
| 22354 | 0.005 |
| 22355 | 0.012 |
| 22356 | 0.009 |
| 22357 | 0.006 |
| 22358 | 0.006 |
| 22359 | 0.005 |
| 22360 | 0.002 |
| 22361 | 0.006 |
| 22362 | 0.002 |
| 22363 | 0.006 |
| 22364 | 0.006 |
| 22365 | 0.008 |
| 22366 | 0.01 |
| 22367 | 0.011 |
| 22368 | 0.009 |
| 22369 | 0.009 |
| 22370 | 0.009 |
| 22371 | 0.004 |
| 22372 | 0.003 |
| 22373 | 0.002 |
| 22374 | 0.006 |
| 22375 | 0.003 |
| 22376 | 0.002 |
| 22377 | 0.005 |
| 22378 | 0.002 |
| 22379 | 0.002 |
| 22380 | 0.003 |
| 22381 | 0.01 |
| 22382 | 0.006 |
| 22383 | 0.002 |
| 22384 | 0.003 |
| 22385 | 0.004 |
| 22386 | 0.002 |
| 22387 | 0.005 |
| 22388 | 0.005 |
| 22389 | 0.004 |
| 22390 | 0.008 |
| 22391 | 0.004 |
| 22392 | 0.003 |
| 22393 | 0.005 |
| 22394 | 0.005 |
| 22395 | 0.006 |
| 22396 | 0.006 |
| 22397 | 0.002 |
| 22398 | 0.001 |
| 22399 | 0.004 |
| 22400 | 0.007 |
| 22401 | 0.002 |
| 22402 | 0.001 |
| 22403 | 0.004 |
| 22404 | 0.004 |
| 22405 | 0.003 |
| 22406 | 0.009 |
| 22407 | 0.008 |
| 22408 | 0.003 |
| 22409 | 0.004 |
| 22410 | 0.005 |
| 22411 | 0.008 |
| 22412 | 0.007 |
| 22413 | 0.001 |
| 22414 | 0.006 |
| 22415 | 0.002 |
| 22416 | 0.005 |
| 22417 | 0.007 |
| 22418 | 0.004 |
| 22419 | 0.006 |
| 22420 | 0.005 |
| 22421 | 0.002 |
| 22422 | 0.003 |
| 22423 | 0.009 |
| 22424 | 0.006 |
| 22425 | 0.005 |
| 22426 | 0.002 |
| 22427 | 0.003 |
| 22428 | 0.004 |
| 22429 | 0.006 |
| 22430 | 0.001 |
| 22431 | 0.003 |
| 22432 | 0.002 |
| 22433 | 0.004 |
| 22434 | 0.002 |
| 22435 | 0.002 |
| 22436 | 0.009 |
| 22437 | 0.002 |
| 22438 | 0.003 |
| 22439 | 0.004 |
| 22440 | 0.003 |
| 22441 | 0.006 |
| 22442 | 0.003 |
| 22443 | 0.001 |
| 22444 | 0.004 |
| 22445 | 0.004 |
| 22446 | 0.001 |
| 22447 | 0.002 |
| 22448 | 0.004 |
| 22449 | 0.002 |
| 22450 | 0.003 |
| 22451 | 0.004 |
| 22452 | 0.009 |
| 22453 | 0.004 |
| 22454 | 0.005 |
| 22455 | 0.001 |
| 22456 | 0.002 |
| 22457 | 0.002 |
| 22458 | 0.004 |
| 22459 | 0.005 |
| 22460 | 0.004 |
| 22461 | 0.001 |
| 22462 | 0.003 |
| 22463 | 0.004 |
| 22464 | 0.002 |
| 22465 | 0.001 |
| 22466 | 0.004 |
| 22467 | 0.009 |
| 22468 | 0.002 |
| 22469 | 0.004 |
| 22470 | 0.003 |
| 22471 | 0.004 |
| 22472 | 0.005 |
| 22473 | 0.005 |
| 22474 | 0.006 |
| 22475 | 0.005 |
| 22476 | 0.007 |
| 22477 | 0.002 |
| 22478 | 0.002 |
| 22479 | 0.003 |
| 22480 | 0.003 |
| 22481 | 0.004 |
| 22482 | 0.002 |
| 22483 | 0.002 |
| 22484 | 0.004 |
| 22485 | 0.004 |
| 22486 | 0.004 |
| 22487 | 0.002 |
| 22488 | 0.005 |
| 22489 | 0.006 |
| 22490 | 0.004 |
| 22491 | 0.005 |
| 22492 | 0.004 |
| 22493 | 0.007 |
| 22494 | 0.003 |
| 22495 | 0.003 |
| 22496 | 0.002 |
| 22497 | 0.002 |
| 22498 | 0.007 |
| 22499 | 0.007 |
| 22500 | 0.002 |
| 22501 | 0.001 |
| 22502 | 0.002 |
| 22503 | 0.003 |
| 22504 | 0.003 |
| 22505 | 0.002 |
| 22506 | 0.005 |
| 22507 | 0.003 |
| 22508 | 0.005 |
| 22509 | 0.005 |
| 22510 | 0.004 |
| 22511 | 0.008 |
| 22512 | 0.004 |
| 22513 | 0.004 |
| 22514 | 0.003 |
| 22515 | 0.003 |
| 22516 | 0.003 |
| 22517 | 0.002 |
| 22518 | 0.002 |
| 22519 | 0.004 |
| 22520 | 0.003 |
| 22521 | 0.003 |
| 22522 | 0.003 |
| 22523 | 0.005 |
| 22524 | 0.004 |
| 22525 | 0.005 |
| 22526 | 0.004 |
| 22527 | 0.006 |
| 22528 | 0.005 |
| 22529 | 0.003 |
| 22530 | 0.001 |
| 22531 | 0.003 |
| 22532 | 0.004 |
| 22533 | 0.002 |
| 22534 | 0.002 |
| 22535 | 0.001 |
| 22536 | 0.005 |
| 22537 | 0.002 |
| 22538 | 0.007 |
| 22539 | 0.002 |
| 22540 | 0.004 |
| 22541 | 0.003 |
| 22542 | 0.002 |
| 22543 | 0.004 |
| 22544 | 0.006 |
| 22545 | 0.002 |
| 22546 | 0.004 |
| 22547 | 0.003 |
| 22548 | 0.004 |
| 22549 | 0.002 |
| 22550 | 0.002 |
| 22551 | 0.01 |
| 22552 | 0.005 |
| 22553 | 0.003 |
| 22554 | 0.004 |
| 22555 | 0.004 |
| 22556 | 0.009 |
| 22557 | 0.001 |
| 22558 | 0.006 |
| 22559 | 0.007 |
| 22560 | 0.003 |
| 22561 | 0.003 |
| 22562 | 0.006 |
| 22563 | 0.007 |
| 22564 | 0.006 |
| 22565 | 0.005 |
| 22566 | 0.007 |
| 22567 | 0.013 |
| 22568 | 0.006 |
| 22569 | 0.005 |
| 22570 | 0.003 |
| 22571 | 0.006 |
| 22572 | 0.005 |
| 22573 | 0.004 |
| 22574 | 0.002 |
| 22575 | 0.003 |
| 22576 | 0.003 |
| 22577 | 0.004 |
| 22578 | 0.003 |
| 22579 | 0.009 |
| 22580 | 0.006 |
| 22581 | 0.004 |
| 22582 | 0.004 |
| 22583 | 0.004 |
| 22584 | 0.005 |
| 22585 | 0.005 |
| 22586 | 0.001 |
| 22587 | 0.001 |
| 22588 | 0.002 |
| 22589 | 0.001 |
| 22590 | 0.001 |
| 22591 | 0.002 |
| 22592 | 0.004 |
| 22593 | 0.003 |
| 22594 | 0.002 |
| 22595 | 0.002 |
| 22596 | 0.007 |
| 22597 | 0.004 |
| 22598 | 0.003 |
| 22599 | 0.004 |
| 22600 | 0.002 |
| 22601 | 0.003 |
| 22602 | 0.003 |
| 22603 | 0.006 |
| 22604 | 0.003 |
| 22605 | 0.001 |
| 22606 | 0.005 |
| 22607 | 0.007 |
| 22608 | 0.009 |
| 22609 | 0.007 |
| 22610 | 0.009 |
| 22611 | 0.006 |
| 22612 | 0.002 |
| 22613 | 0.003 |
| 22614 | 0.001 |
| 22615 | 0.006 |
| 22616 | 0.001 |
| 22617 | 0.006 |
| 22618 | 0.006 |
| 22619 | 0.002 |
| 22620 | 0.001 |
| 22621 | 0.005 |
| 22622 | 0.004 |
| 22623 | 0.006 |
| 22624 | 0.008 |
| 22625 | 0.006 |
| 22626 | 0.003 |
| 22627 | 0.002 |
| 22628 | 0.002 |
| 22629 | 0.003 |
| 22630 | 0.005 |
| 22631 | 0.003 |
| 22632 | 0.006 |
| 22633 | 0.004 |
| 22634 | 0.004 |
| 22635 | 0.005 |
| 22636 | 0.007 |
| 22637 | 0.006 |
| 22638 | 0.002 |
| 22639 | 0.003 |
| 22640 | 0.014 |
| 22641 | 0.004 |
| 22642 | 0.003 |
| 22643 | 0.002 |
| 22644 | 0.003 |
| 22645 | 0.009 |
| 22646 | 0.002 |
| 22647 | 0.003 |
| 22648 | 0.003 |
| 22649 | 0.008 |
| 22650 | 0.002 |
| 22651 | 0.005 |
| 22652 | 0.005 |
| 22653 | 0.006 |
| 22654 | 0.003 |
| 22655 | 0.004 |
| 22656 | 0.008 |
| 22657 | 0.003 |
| 22658 | 0.002 |
| 22659 | 0.001 |
| 22660 | 0.002 |
| 22661 | 0.004 |
| 22662 | 0.003 |
| 22663 | 0.001 |
| 22664 | 0.012 |
| 22665 | 0.007 |
| 22666 | 0.001 |
| 22667 | 0.003 |
| 22668 | 0.004 |
| 22669 | 0.006 |
| 22670 | 0.003 |
| 22671 | 0.003 |
| 22672 | 0.005 |
| 22673 | 0.004 |
| 22674 | 0.002 |
| 22675 | 0.002 |
| 22676 | 0.004 |
| 22677 | 0.004 |
| 22678 | 0.002 |
| 22679 | 0.003 |
| 22680 | 0.006 |
| 22681 | 0.001 |
| 22682 | 0.004 |
| 22683 | 0.002 |
| 22684 | 0.004 |
| 22685 | 0.007 |
| 22686 | 0.002 |
| 22687 | 0.003 |
| 22688 | 0.004 |
| 22689 | 0.006 |
| 22690 | 0.001 |
| 22691 | 0.005 |
| 22692 | 0.002 |
| 22693 | 0.005 |
| 22694 | 0.003 |
| 22695 | 0.006 |
| 22696 | 0.007 |
| 22697 | 0.003 |
| 22698 | 0.003 |
| 22699 | 0.006 |
| 22700 | 0.007 |
| 22701 | 0.006 |
| 22702 | 0.003 |
| 22703 | 0.002 |
| 22704 | 0.005 |
| 22705 | 0.007 |
| 22706 | 0.003 |
| 22707 | 0.003 |
| 22708 | 0.002 |
| 22709 | 0.008 |
| 22710 | 0.003 |
| 22711 | 0.004 |
| 22712 | 0.008 |
| 22713 | 0.005 |
| 22714 | 0.001 |
| 22715 | 0.002 |
| 22716 | 0.006 |
| 22717 | 0.005 |
| 22718 | 0.001 |
| 22719 | 0.007 |
| 22720 | 0.005 |
| 22721 | 0.005 |
| 22722 | 0.004 |
| 22723 | 0.003 |
| 22724 | 0.002 |
| 22725 | 0.004 |
| 22726 | 0.003 |
| 22727 | 0.004 |
| 22728 | 0.007 |
| 22729 | 0.004 |
| 22730 | 0.001 |
| 22731 | 0.002 |
| 22732 | 0.005 |
| 22733 | 0.011 |
| 22734 | 0.001 |
| 22735 | 0.001 |
| 22736 | 0.004 |
| 22737 | 0.002 |
| 22738 | 0.002 |
| 22739 | 0.004 |
| 22740 | 0.004 |
| 22741 | 0.008 |
| 22742 | 0.002 |
| 22743 | 0.004 |
| 22744 | 0.008 |
| 22745 | 0.004 |
| 22746 | 0.005 |
| 22747 | 0.002 |
| 22748 | 0.002 |
| 22749 | 0.006 |
| 22750 | 0.003 |
| 22751 | 0.004 |
| 22752 | 0.005 |
| 22753 | 0.008 |
| 22754 | 0.004 |
| 22755 | 0.004 |
| 22756 | 0.005 |
| 22757 | 0.005 |
| 22758 | 0.001 |
| 22759 | 0.003 |
| 22760 | 0.001 |
| 22761 | 0.007 |
| 22762 | 0.001 |
| 22763 | 0.002 |
| 22764 | 0.005 |
| 22765 | 0.006 |
| 22766 | 0.002 |
| 22767 | 0.003 |
| 22768 | 0.011 |
| 22769 | 0.009 |
| 22770 | 0.004 |
| 22771 | 0.004 |
| 22772 | 0.003 |
| 22773 | 0.004 |
| 22774 | 0.002 |
| 22775 | 0.001 |
| 22776 | 0.004 |
| 22777 | 0.003 |
| 22778 | 0.003 |
| 22779 | 0.003 |
| 22780 | 0.005 |
| 22781 | 0.003 |
| 22782 | 0.003 |
| 22783 | 0.002 |
| 22784 | 0.005 |
| 22785 | 0.006 |
| 22786 | 0.001 |
| 22787 | 0.003 |
| 22788 | 0.004 |
| 22789 | 0.008 |
| 22790 | 0.003 |
| 22791 | 0.003 |
| 22792 | 0.003 |
| 22793 | 0.006 |
| 22794 | 0.004 |
| 22795 | 0.002 |
| 22796 | 0.006 |
| 22797 | 0.006 |
| 22798 | 0.004 |
| 22799 | 0.005 |
| 22800 | 0.006 |
| 22801 | 0.004 |
| 22802 | 0.003 |
| 22803 | 0.004 |
| 22804 | 0.003 |
| 22805 | 0.004 |
| 22806 | 0.004 |
| 22807 | 0.002 |
| 22808 | 0.007 |
| 22809 | 0.005 |
| 22810 | 0.004 |
| 22811 | 0.002 |
| 22812 | 0.003 |
| 22813 | 0.002 |
| 22814 | 0.004 |
| 22815 | 0.003 |
| 22816 | 0.001 |
| 22817 | 0.002 |
| 22818 | 0.003 |
| 22819 | 0.004 |
| 22820 | 0.006 |
| 22821 | 0.003 |
| 22822 | 0.003 |
| 22823 | 0.006 |
| 22824 | 0.004 |
| 22825 | 0.003 |
| 22826 | 0.003 |
| 22827 | 0.003 |
| 22828 | 0.006 |
| 22829 | 0.007 |
| 22830 | 0.003 |
| 22831 | 0.004 |
| 22832 | 0.002 |
| 22833 | 0.003 |
| 22834 | 0.003 |
| 22835 | 0.008 |
| 22836 | 0.002 |
| 22837 | 0.01 |
| 22838 | 0.015 |
| 22839 | 0.008 |
| 22840 | 0.01 |
| 22841 | 0.002 |
| 22842 | 0.003 |
| 22843 | 0.003 |
| 22844 | 0.004 |
| 22845 | 0.004 |
| 22846 | 0.002 |
| 22847 | 0.006 |
| 22848 | 0.004 |
| 22849 | 0.003 |
| 22850 | 0.004 |
| 22851 | 0.002 |
| 22852 | 0.008 |
| 22853 | 0.003 |
| 22854 | 0.005 |
| 22855 | 0.005 |
| 22856 | 0.007 |
| 22857 | 0.004 |
| 22858 | 0.006 |
| 22859 | 0.008 |
| 22860 | 0.008 |
| 22861 | 0.003 |
| 22862 | 0.006 |
| 22863 | 0.008 |
| 22864 | 0.009 |
| 22865 | 0.003 |
| 22866 | 0.004 |
| 22867 | 0.007 |
| 22868 | 0.005 |
| 22869 | 0.003 |
| 22870 | 0.002 |
| 22871 | 0.005 |
| 22872 | 0.002 |
| 22873 | 0.003 |
| 22874 | 0.001 |
| 22875 | 0.003 |
| 22876 | 0.007 |
| 22877 | 0.002 |
| 22878 | 0.005 |
| 22879 | 0.003 |
| 22880 | 0.003 |
| 22881 | 0.003 |
| 22882 | 0.003 |
| 22883 | 0.002 |
| 22884 | 0.006 |
| 22885 | 0.002 |
| 22886 | 0.002 |
| 22887 | 0.003 |
| 22888 | 0.006 |
| 22889 | 0.003 |
| 22890 | 0.004 |
| 22891 | 0.003 |
| 22892 | 0.004 |
| 22893 | 0.004 |
| 22894 | 0.003 |
| 22895 | 0.005 |
| 22896 | 0.005 |
| 22897 | 0.004 |
| 22898 | 0.002 |
| 22899 | 0.004 |
| 22900 | 0.008 |
| 22901 | 0.004 |
| 22902 | 0.005 |
| 22903 | 0.007 |
| 22904 | 0.002 |
| 22905 | 0.002 |
| 22906 | 0.003 |
| 22907 | 0.011 |
| 22908 | 0.011 |
| 22909 | 0.003 |
| 22910 | 0.002 |
| 22911 | 0.002 |
| 22912 | 0.004 |
| 22913 | 0.006 |
| 22914 | 0.001 |
| 22915 | 0.001 |
| 22916 | 0.004 |
| 22917 | 0.009 |
| 22918 | 0.004 |
| 22919 | 0.008 |
| 22920 | 0.008 |
| 22921 | 0.007 |
| 22922 | 0.002 |
| 22923 | 0.004 |
| 22924 | 0.008 |
| 22925 | 0.007 |
| 22926 | 0.009 |
| 22927 | 0.001 |
| 22928 | 0.003 |
| 22929 | 0.008 |
| 22930 | 0.004 |
| 22931 | 0.002 |
| 22932 | 0.001 |
| 22933 | 0.002 |
| 22934 | 0.005 |
| 22935 | 0.004 |
| 22936 | 0.003 |
| 22937 | 0.004 |
| 22938 | 0.001 |
| 22939 | 0.002 |
| 22940 | 0.002 |
| 22941 | 0.001 |
| 22942 | 0.004 |
| 22943 | 0.003 |
| 22944 | 0.002 |
| 22945 | 0.001 |
| 22946 | 0.001 |
| 22947 | 0.005 |
| 22948 | 0.001 |
| 22949 | 0.003 |
| 22950 | 0.005 |
| 22951 | 0.003 |
| 22952 | 0.004 |
| 22953 | 0.002 |
| 22954 | 0.004 |
| 22955 | 0.008 |
| 22956 | 0.005 |
| 22957 | 0.004 |
| 22958 | 0.004 |
| 22959 | 0.005 |
| 22960 | 0.003 |
| 22961 | 0.007 |
| 22962 | 0.006 |
| 22963 | 0.005 |
| 22964 | 0.002 |
| 22965 | 0.005 |
| 22966 | 0.002 |
| 22967 | 0.004 |
| 22968 | 0.005 |
| 22969 | 0.006 |
| 22970 | 0.008 |
| 22971 | 0.006 |
| 22972 | 0.007 |
| 22973 | 0.008 |
| 22974 | 0.005 |
| 22975 | 0.005 |
| 22976 | 0.005 |
| 22977 | 0.002 |
| 22978 | 0.004 |
| 22979 | 0.009 |
| 22980 | 0.009 |
| 22981 | 0.005 |
| 22982 | 0.008 |
| 22983 | 0.006 |
| 22984 | 0.005 |
| 22985 | 0.008 |
| 22986 | 0.007 |
| 22987 | 0.004 |
| 22988 | 0.001 |
| 22989 | 0.005 |
| 22990 | 0.004 |
| 22991 | 0.005 |
| 22992 | 0.013 |
| 22993 | 0.002 |
| 22994 | 0.003 |
| 22995 | 0.006 |
| 22996 | 0.008 |
| 22997 | 0.006 |
| 22998 | 0.008 |
| 22999 | 0.008 |
| 23000 | 0.002 |
| 23001 | 0.002 |
| 23002 | 0.004 |
| 23003 | 0.006 |
| 23004 | 0.004 |
| 23005 | 0.002 |
| 23006 | 0.003 |
| 23007 | 0.006 |
| 23008 | 0.006 |
| 23009 | 0.004 |
| 23010 | 0.005 |
| 23011 | 0.003 |
| 23012 | 0.002 |
| 23013 | 0.004 |
| 23014 | 0.003 |
| 23015 | 0.005 |
| 23016 | 0.006 |
| 23017 | 0.002 |
| 23018 | 0.001 |
| 23019 | 0.007 |
| 23020 | 0.002 |
| 23021 | 0.003 |
| 23022 | 0.003 |
| 23023 | 0.005 |
| 23024 | 0.003 |
| 23025 | 0.003 |
| 23026 | 0.006 |
| 23027 | 0.009 |
| 23028 | 0.003 |
| 23029 | 0.004 |
| 23030 | 0.003 |
| 23031 | 0.005 |
| 23032 | 0.007 |
| 23033 | 0.002 |
| 23034 | 0.003 |
| 23035 | 0.005 |
| 23036 | 0.003 |
| 23037 | 0.004 |
| 23038 | 0.004 |
| 23039 | 0.003 |
| 23040 | 0.003 |
| 23041 | 0.005 |
| 23042 | 0.006 |
| 23043 | 0.005 |
| 23044 | 0.003 |
| 23045 | 0.004 |
| 23046 | 0.004 |
| 23047 | 0.001 |
| 23048 | 0.005 |
| 23049 | 0.005 |
| 23050 | 0.002 |
| 23051 | 0.002 |
| 23052 | 0.004 |
| 23053 | 0.007 |
| 23054 | 0.002 |
| 23055 | 0.002 |
| 23056 | 0.005 |
| 23057 | 0.004 |
| 23058 | 0.004 |
| 23059 | 0.004 |
| 23060 | 0.002 |
| 23061 | 0.007 |
| 23062 | 0.002 |
| 23063 | 0.004 |
| 23064 | 0.003 |
| 23065 | 0.004 |
| 23066 | 0.002 |
| 23067 | 0.003 |
| 23068 | 0.01 |
| 23069 | 0.006 |
| 23070 | 0.007 |
| 23071 | 0.002 |
| 23072 | 0.004 |
| 23073 | 0.009 |
| 23074 | 0.006 |
| 23075 | 0.006 |
| 23076 | 0.005 |
| 23077 | 0.005 |
| 23078 | 0.002 |
| 23079 | 0.003 |
| 23080 | 0.004 |
| 23081 | 0.004 |
| 23082 | 0.004 |
| 23083 | 0.005 |
| 23084 | 0.005 |
| 23085 | 0.007 |
| 23086 | 0.003 |
| 23087 | 0.002 |
| 23088 | 0.005 |
| 23089 | 0.009 |
| 23090 | 0.003 |
| 23091 | 0.002 |
| 23092 | 0.003 |
| 23093 | 0.007 |
| 23094 | 0.002 |
| 23095 | 0.004 |
| 23096 | 0.006 |
| 23097 | 0.004 |
| 23098 | 0.004 |
| 23099 | 0.005 |
| 23100 | 0.006 |
| 23101 | 0.005 |
| 23102 | 0.002 |
| 23103 | 0.003 |
| 23104 | 0.006 |
| 23105 | 0.001 |
| 23106 | 0.01 |
| 23107 | 0.004 |
| 23108 | 0.005 |
| 23109 | 0.007 |
| 23110 | 0.002 |
| 23111 | 0.004 |
| 23112 | 0.003 |
| 23113 | 0.006 |
| 23114 | 0.002 |
| 23115 | 0.006 |
| 23116 | 0.011 |
| 23117 | 0.007 |
| 23118 | 0.004 |
| 23119 | 0.003 |
| 23120 | 0.003 |
| 23121 | 0.006 |
| 23122 | 0.001 |
| 23123 | 0.004 |
| 23124 | 0.003 |
| 23125 | 0.003 |
| 23126 | 0.003 |
| 23127 | 0.003 |
| 23128 | 0.004 |
| 23129 | 0.003 |
| 23130 | 0.004 |
| 23131 | 0.003 |
| 23132 | 0.002 |
| 23133 | 0.003 |
| 23134 | 0.002 |
| 23135 | 0.008 |
| 23136 | 0.001 |
| 23137 | 0.002 |
| 23138 | 0.002 |
| 23139 | 0.011 |
| 23140 | 0.009 |
| 23141 | 0.002 |
| 23142 | 0.004 |
| 23143 | 0.004 |
| 23144 | 0.007 |
| 23145 | 0.003 |
| 23146 | 0.002 |
| 23147 | 0.003 |
| 23148 | 0.009 |
| 23149 | 0.002 |
| 23150 | 0.001 |
| 23151 | 0.004 |
| 23152 | 0.006 |
| 23153 | 0.001 |
| 23154 | 0.004 |
| 23155 | 0.006 |
| 23156 | 0.001 |
| 23157 | 0.003 |
| 23158 | 0.008 |
| 23159 | 0.011 |
| 23160 | 0.017 |
| 23161 | 0.003 |
| 23162 | 0.003 |
| 23163 | 0.004 |
| 23164 | 0.004 |
| 23165 | 0.003 |
| 23166 | 0.003 |
| 23167 | 0.002 |
| 23168 | 0.006 |
| 23169 | 0.002 |
| 23170 | 0.001 |
| 23171 | 0.003 |
| 23172 | 0.005 |
| 23173 | 0.003 |
| 23174 | 0.004 |
| 23175 | 0.005 |
| 23176 | 0.001 |
| 23177 | 0.005 |
| 23178 | 0.005 |
| 23179 | 0.003 |
| 23180 | 0.003 |
| 23181 | 0.002 |
| 23182 | 0.002 |
| 23183 | 0.006 |
| 23184 | 0.007 |
| 23185 | 0.007 |
| 23186 | 0.001 |
| 23187 | 0.003 |
| 23188 | 0.006 |
| 23189 | 0.006 |
| 23190 | 0.003 |
| 23191 | 0.008 |
| 23192 | 0.003 |
| 23193 | 0.003 |
| 23194 | 0.002 |
| 23195 | 0.005 |
| 23196 | 0.003 |
| 23197 | 0.002 |
| 23198 | 0.001 |
| 23199 | 0.006 |
| 23200 | 0.004 |
| 23201 | 0.005 |
| 23202 | 0.001 |
| 23203 | 0.002 |
| 23204 | 0.005 |
| 23205 | 0.007 |
| 23206 | 0.002 |
| 23207 | 0.004 |
| 23208 | 0.004 |
| 23209 | 0.004 |
| 23210 | 0.002 |
| 23211 | 0.002 |
| 23212 | 0.005 |
| 23213 | 0.006 |
| 23214 | 0.005 |
| 23215 | 0.004 |
| 23216 | 0.007 |
| 23217 | 0.006 |
| 23218 | 0.003 |
| 23219 | 0.005 |
| 23220 | 0.007 |
| 23221 | 0.008 |
| 23222 | 0.002 |
| 23223 | 0.002 |
| 23224 | 0.005 |
| 23225 | 0.006 |
| 23226 | 0.001 |
| 23227 | 0.005 |
| 23228 | 0.001 |
| 23229 | 0.002 |
| 23230 | 0.002 |
| 23231 | 0.007 |
| 23232 | 0.006 |
| 23233 | 0.001 |
| 23234 | 0.003 |
| 23235 | 0.004 |
| 23236 | 0.002 |
| 23237 | 0.001 |
| 23238 | 0.003 |
| 23239 | 0.005 |
| 23240 | 0.003 |
| 23241 | 0.004 |
| 23242 | 0.003 |
| 23243 | 0.002 |
| 23244 | 0.002 |
| 23245 | 0.004 |
| 23246 | 0.008 |
| 23247 | 0.002 |
| 23248 | 0.006 |
| 23249 | 0.005 |
| 23250 | 0.005 |
| 23251 | 0.004 |
| 23252 | 0.003 |
| 23253 | 0.002 |
| 23254 | 0.009 |
| 23255 | 0.003 |
| 23256 | 0.004 |
| 23257 | 0.002 |
| 23258 | 0.006 |
| 23259 | 0.005 |
| 23260 | 0.006 |
| 23261 | 0.002 |
| 23262 | 0.006 |
| 23263 | 0.005 |
| 23264 | 0.002 |
| 23265 | 0.006 |
| 23266 | 0.006 |
| 23267 | 0.006 |
| 23268 | 0.003 |
| 23269 | 0.004 |
| 23270 | 0.008 |
| 23271 | 0.006 |
| 23272 | 0.005 |
| 23273 | 0.004 |
| 23274 | 0.004 |
| 23275 | 0.003 |
| 23276 | 0.002 |
| 23277 | 0.005 |
| 23278 | 0.005 |
| 23279 | 0.003 |
| 23280 | 0.005 |
| 23281 | 0.002 |
| 23282 | 0.004 |
| 23283 | 0.008 |
| 23284 | 0.002 |
| 23285 | 0.002 |
| 23286 | 0.006 |
| 23287 | 0.003 |
| 23288 | 0.004 |
| 23289 | 0.002 |
| 23290 | 0.003 |
| 23291 | 0.003 |
| 23292 | 0.007 |
| 23293 | 0.008 |
| 23294 | 0.002 |
| 23295 | 0.002 |
| 23296 | 0.002 |
| 23297 | 0.003 |
| 23298 | 0.002 |
| 23299 | 0.002 |
| 23300 | 0.005 |
| 23301 | 0.006 |
| 23302 | 0.001 |
| 23303 | 0.002 |
| 23304 | 0.003 |
| 23305 | 0.002 |
| 23306 | 0.004 |
| 23307 | 0.004 |
| 23308 | 0.003 |
| 23309 | 0.004 |
| 23310 | 0.005 |
| 23311 | 0.004 |
| 23312 | 0.004 |
| 23313 | 0.003 |
| 23314 | 0.002 |
| 23315 | 0.002 |
| 23316 | 0.004 |
| 23317 | 0.002 |
| 23318 | 0.004 |
| 23319 | 0.003 |
| 23320 | 0.003 |
| 23321 | 0.003 |
| 23322 | 0.003 |
| 23323 | 0.001 |
| 23324 | 0.005 |
| 23325 | 0.002 |
| 23326 | 0.007 |
| 23327 | 0.002 |
| 23328 | 0.007 |
| 23329 | 0.006 |
| 23330 | 0.003 |
| 23331 | 0.003 |
| 23332 | 0.003 |
| 23333 | 0.003 |
| 23334 | 0.002 |
| 23335 | 0.004 |
| 23336 | 0.004 |
| 23337 | 0.004 |
| 23338 | 0.004 |
| 23339 | 0.006 |
| 23340 | 0.003 |
| 23341 | 0.003 |
| 23342 | 0.001 |
| 23343 | 0.007 |
| 23344 | 0.009 |
| 23345 | 0.002 |
| 23346 | 0.005 |
| 23347 | 0.01 |
| 23348 | 0.003 |
| 23349 | 0.003 |
| 23350 | 0.004 |
| 23351 | 0.005 |
| 23352 | 0.003 |
| 23353 | 0.005 |
| 23354 | 0.004 |
| 23355 | 0.01 |
| 23356 | 0.006 |
| 23357 | 0.003 |
| 23358 | 0.002 |
| 23359 | 0.005 |
| 23360 | 0.007 |
| 23361 | 0.002 |
| 23362 | 0.002 |
| 23363 | 0.006 |
| 23364 | 0.005 |
| 23365 | 0.002 |
| 23366 | 0.004 |
| 23367 | 0.005 |
| 23368 | 0.009 |
| 23369 | 0.002 |
| 23370 | 0.003 |
| 23371 | 0.005 |
| 23372 | 0.006 |
| 23373 | 0.002 |
| 23374 | 0.002 |
| 23375 | 0.005 |
| 23376 | 0.003 |
| 23377 | 0.002 |
| 23378 | 0.001 |
| 23379 | 0.002 |
| 23380 | 0.005 |
| 23381 | 0.005 |
| 23382 | 0.011 |
| 23383 | 0.004 |
| 23384 | 0.004 |
| 23385 | 0.007 |
| 23386 | 0.002 |
| 23387 | 0.004 |
| 23388 | 0.005 |
| 23389 | 0.01 |
| 23390 | 0.003 |
| 23391 | 0.004 |
| 23392 | 0.014 |
| 23393 | 0.011 |
| 23394 | 0.004 |
| 23395 | 0.005 |
| 23396 | 0.002 |
| 23397 | 0.005 |
| 23398 | 0.004 |
| 23399 | 0.003 |
| 23400 | 0.004 |
| 23401 | 0.006 |
| 23402 | 0.003 |
| 23403 | 0.002 |
| 23404 | 0.003 |
| 23405 | 0.005 |
| 23406 | 0.002 |
| 23407 | 0.004 |
| 23408 | 0.004 |
| 23409 | 0.007 |
| 23410 | 0.007 |
| 23411 | 0.003 |
| 23412 | 0.004 |
| 23413 | 0.002 |
| 23414 | 0.003 |
| 23415 | 0.007 |
| 23416 | 0.003 |
| 23417 | 0.002 |
| 23418 | 0.002 |
| 23419 | 0.004 |
| 23420 | 0.004 |
| 23421 | 0.002 |
| 23422 | 0.004 |
| 23423 | 0.003 |
| 23424 | 0.008 |
| 23425 | 0.001 |
| 23426 | 0.002 |
| 23427 | 0.004 |
| 23428 | 0.006 |
| 23429 | 0.003 |
| 23430 | 0.006 |
| 23431 | 0.01 |
| 23432 | 0.005 |
| 23433 | 0.002 |
| 23434 | 0.002 |
| 23435 | 0.004 |
| 23436 | 0.004 |
| 23437 | 0.003 |
| 23438 | 0.004 |
| 23439 | 0.004 |
| 23440 | 0.005 |
| 23441 | 0.003 |
| 23442 | 0.002 |
| 23443 | 0.008 |
| 23444 | 0.002 |
| 23445 | 0.003 |
| 23446 | 0.003 |
| 23447 | 0.004 |
| 23448 | 0.006 |
| 23449 | 0.004 |
| 23450 | 0.004 |
| 23451 | 0.002 |
| 23452 | 0.001 |
| 23453 | 0.002 |
| 23454 | 0.005 |
| 23455 | 0.002 |
| 23456 | 0.005 |
| 23457 | 0.004 |
| 23458 | 0.002 |
| 23459 | 0.008 |
| 23460 | 0.006 |
| 23461 | 0.001 |
| 23462 | 0.002 |
| 23463 | 0.004 |
| 23464 | 0.005 |
| 23465 | 0.004 |
| 23466 | 0.003 |
| 23467 | 0.002 |
| 23468 | 0.008 |
| 23469 | 0.011 |
| 23470 | 0.005 |
| 23471 | 0.008 |
| 23472 | 0.007 |
| 23473 | 0.003 |
| 23474 | 0.001 |
| 23475 | 0.001 |
| 23476 | 0.002 |
| 23477 | 0.006 |
| 23478 | 0.004 |
| 23479 | 0.004 |
| 23480 | 0.007 |
| 23481 | 0.013 |
| 23482 | 0.001 |
| 23483 | 0.001 |
| 23484 | 0.004 |
| 23485 | 0.003 |
| 23486 | 0.003 |
| 23487 | 0.003 |
| 23488 | 0.008 |
| 23489 | 0.006 |
| 23490 | 0.002 |
| 23491 | 0.002 |
| 23492 | 0.003 |
| 23493 | 0.002 |
| 23494 | 0.002 |
| 23495 | 0.005 |
| 23496 | 0.008 |
| 23497 | 0.003 |
| 23498 | 0.004 |
| 23499 | 0.002 |
| 23500 | 0.003 |
| 23501 | 0.002 |
| 23502 | 0.003 |
| 23503 | 0.003 |
| 23504 | 0.003 |
| 23505 | 0.003 |
| 23506 | 0.001 |
| 23507 | 0.003 |
| 23508 | 0.004 |
| 23509 | 0.002 |
| 23510 | 0.004 |
| 23511 | 0.004 |
| 23512 | 0.003 |
| 23513 | 0.004 |
| 23514 | 0.005 |
| 23515 | 0.003 |
| 23516 | 0.002 |
| 23517 | 0 |
| 23518 | 0.001 |
| 23519 | 0.005 |
| 23520 | 0.002 |
| 23521 | 0.003 |
| 23522 | 0.003 |
| 23523 | 0.004 |
| 23524 | 0.002 |
| 23525 | 0.002 |
| 23526 | 0.006 |
| 23527 | 0.007 |
| 23528 | 0.001 |
| 23529 | 0.001 |
| 23530 | 0.001 |
| 23531 | 0.008 |
| 23532 | 0.013 |
| 23533 | 0.007 |
| 23534 | 0.011 |
| 23535 | 0.003 |
| 23536 | 0.004 |
| 23537 | 0.001 |
| 23538 | 0.004 |
| 23539 | 0.004 |
| 23540 | 0.003 |
| 23541 | 0.006 |
| 23542 | 0.005 |
| 23543 | 0.005 |
| 23544 | 0.002 |
| 23545 | 0.006 |
| 23546 | 0.003 |
| 23547 | 0.004 |
| 23548 | 0.003 |
| 23549 | 0.002 |
| 23550 | 0.005 |
| 23551 | 0.008 |
| 23552 | 0.003 |
| 23553 | 0.004 |
| 23554 | 0.003 |
| 23555 | 0.001 |
| 23556 | 0.004 |
| 23557 | 0.002 |
| 23558 | 0.003 |
| 23559 | 0.004 |
| 23560 | 0.007 |
| 23561 | 0.003 |
| 23562 | 0.005 |
| 23563 | 0.009 |
| 23564 | 0.013 |
| 23565 | 0.006 |
| 23566 | 0.003 |
| 23567 | 0.003 |
| 23568 | 0.003 |
| 23569 | 0.004 |
| 23570 | 0.005 |
| 23571 | 0.007 |
| 23572 | 0.003 |
| 23573 | 0.011 |
| 23574 | 0.008 |
| 23575 | 0.002 |
| 23576 | 0.003 |
| 23577 | 0.006 |
| 23578 | 0.005 |
| 23579 | 0.007 |
| 23580 | 0.005 |
| 23581 | 0.002 |
| 23582 | 0.007 |
| 23583 | 0.003 |
| 23584 | 0.006 |
| 23585 | 0.006 |
| 23586 | 0.003 |
| 23587 | 0.004 |
| 23588 | 0.008 |
| 23589 | 0.005 |
| 23590 | 0.002 |
| 23591 | 0.006 |
| 23592 | 0.002 |
| 23593 | 0.004 |
| 23594 | 0.003 |
| 23595 | 0.006 |
| 23596 | 0.005 |
| 23597 | 0.004 |
| 23598 | 0.004 |
| 23599 | 0.003 |
| 23600 | 0.004 |
| 23601 | 0.003 |
| 23602 | 0.001 |
| 23603 | 0.001 |
| 23604 | 0.004 |
| 23605 | 0.009 |
| 23606 | 0.004 |
| 23607 | 0.002 |
| 23608 | 0.002 |
| 23609 | 0.004 |
| 23610 | 0.004 |
| 23611 | 0.01 |
| 23612 | 0.005 |
| 23613 | 0.004 |
| 23614 | 0.004 |
| 23615 | 0.009 |
| 23616 | 0.006 |
| 23617 | 0.002 |
| 23618 | 0.003 |
| 23619 | 0.005 |
| 23620 | 0.003 |
| 23621 | 0.003 |
| 23622 | 0.002 |
| 23623 | 0.003 |
| 23624 | 0.007 |
| 23625 | 0.005 |
| 23626 | 0.004 |
| 23627 | 0.005 |
| 23628 | 0.006 |
| 23629 | 0.003 |
| 23630 | 0.002 |
| 23631 | 0.007 |
| 23632 | 0.005 |
| 23633 | 0.003 |
| 23634 | 0.003 |
| 23635 | 0.006 |
| 23636 | 0.006 |
| 23637 | 0.001 |
| 23638 | 0.002 |
| 23639 | 0.004 |
| 23640 | 0.003 |
| 23641 | 0.006 |
| 23642 | 0.008 |
| 23643 | 0.008 |
| 23644 | 0.004 |
| 23645 | 0.002 |
| 23646 | 0.004 |
| 23647 | 0.002 |
| 23648 | 0.006 |
| 23649 | 0.003 |
| 23650 | 0.004 |
| 23651 | 0.007 |
| 23652 | 0.004 |
| 23653 | 0.003 |
| 23654 | 0.004 |
| 23655 | 0.006 |
| 23656 | 0.005 |
| 23657 | 0.002 |
| 23658 | 0.003 |
| 23659 | 0.008 |
| 23660 | 0.008 |
| 23661 | 0.002 |
| 23662 | 0.006 |
| 23663 | 0.007 |
| 23664 | 0.01 |
| 23665 | 0.003 |
| 23666 | 0.005 |
| 23667 | 0.001 |
| 23668 | 0.002 |
| 23669 | 0.003 |
| 23670 | 0.001 |
| 23671 | 0.005 |
| 23672 | 0.004 |
| 23673 | 0.002 |
| 23674 | 0.006 |
| 23675 | 0.006 |
| 23676 | 0.005 |
| 23677 | 0.002 |
| 23678 | 0.005 |
| 23679 | 0.002 |
| 23680 | 0.003 |
| 23681 | 0.001 |
| 23682 | 0.002 |
| 23683 | 0.003 |
| 23684 | 0.007 |
| 23685 | 0.002 |
| 23686 | 0.002 |
| 23687 | 0 |
| 23688 | 0.003 |
| 23689 | 0.004 |
| 23690 | 0.004 |
| 23691 | 0.005 |
| 23692 | 0.004 |
| 23693 | 0.003 |
| 23694 | 0.002 |
| 23695 | 0.005 |
| 23696 | 0.004 |
| 23697 | 0.004 |
| 23698 | 0.006 |
| 23699 | 0.006 |
| 23700 | 0.002 |
| 23701 | 0.004 |
| 23702 | 0.002 |
| 23703 | 0.003 |
| 23704 | 0.004 |
| 23705 | 0.006 |
| 23706 | 0.005 |
| 23707 | 0.003 |
| 23708 | 0.002 |
| 23709 | 0.003 |
| 23710 | 0.007 |
| 23711 | 0.002 |
| 23712 | 0.003 |
| 23713 | 0.002 |
| 23714 | 0.004 |
| 23715 | 0.003 |
| 23716 | 0.003 |
| 23717 | 0.003 |
| 23718 | 0.002 |
| 23719 | 0.002 |
| 23720 | 0.011 |
| 23721 | 0.01 |
| 23722 | 0.002 |
| 23723 | 0.003 |
| 23724 | 0.002 |
| 23725 | 0.002 |
| 23726 | 0.003 |
| 23727 | 0.003 |
| 23728 | 0.01 |
| 23729 | 0.004 |
| 23730 | 0.002 |
| 23731 | 0.001 |
| 23732 | 0.003 |
| 23733 | 0.003 |
| 23734 | 0.002 |
| 23735 | 0.007 |
| 23736 | 0.004 |
| 23737 | 0.005 |
| 23738 | 0.003 |
| 23739 | 0.007 |
| 23740 | 0.003 |
| 23741 | 0.005 |
| 23742 | 0.005 |
| 23743 | 0.006 |
| 23744 | 0.004 |
| 23745 | 0.006 |
| 23746 | 0.004 |
| 23747 | 0.006 |
| 23748 | 0.002 |
| 23749 | 0.004 |
| 23750 | 0.002 |
| 23751 | 0.002 |
| 23752 | 0.004 |
| 23753 | 0.004 |
| 23754 | 0.001 |
| 23755 | 0.004 |
| 23756 | 0.005 |
| 23757 | 0.004 |
| 23758 | 0.003 |
| 23759 | 0.001 |
| 23760 | 0.004 |
| 23761 | 0.002 |
| 23762 | 0.004 |
| 23763 | 0.006 |
| 23764 | 0.005 |
| 23765 | 0.001 |
| 23766 | 0.002 |
| 23767 | 0.003 |
| 23768 | 0.006 |
| 23769 | 0.002 |
| 23770 | 0.001 |
| 23771 | 0.004 |
| 23772 | 0.005 |
| 23773 | 0.004 |
| 23774 | 0.002 |
| 23775 | 0.003 |
| 23776 | 0.003 |
| 23777 | 0.002 |
| 23778 | 0.003 |
| 23779 | 0.002 |
| 23780 | 0.002 |
| 23781 | 0.001 |
| 23782 | 0.002 |
| 23783 | 0.005 |
| 23784 | 0.002 |
| 23785 | 0.009 |
| 23786 | 0.003 |
| 23787 | 0.002 |
| 23788 | 0.011 |
| 23789 | 0.002 |
| 23790 | 0.002 |
| 23791 | 0.003 |
| 23792 | 0.007 |
| 23793 | 0.003 |
| 23794 | 0.003 |
| 23795 | 0.002 |
| 23796 | 0.005 |
| 23797 | 0.006 |
| 23798 | 0.003 |
| 23799 | 0.002 |
| 23800 | 0.004 |
| 23801 | 0.005 |
| 23802 | 0.001 |
| 23803 | 0.004 |
| 23804 | 0.003 |
| 23805 | 0.004 |
| 23806 | 0.002 |
| 23807 | 0.006 |
| 23808 | 0.002 |
| 23809 | 0.003 |
| 23810 | 0.002 |
| 23811 | 0.003 |
| 23812 | 0.002 |
| 23813 | 0.002 |
| 23814 | 0.001 |
| 23815 | 0.002 |
| 23816 | 0.006 |
| 23817 | 0.002 |
| 23818 | 0.005 |
| 23819 | 0.002 |
| 23820 | 0.005 |
| 23821 | 0.001 |
| 23822 | 0.002 |
| 23823 | 0.007 |
| 23824 | 0.003 |
| 23825 | 0.006 |
| 23826 | 0.005 |
| 23827 | 0.001 |
| 23828 | 0.002 |
| 23829 | 0.003 |
| 23830 | 0.002 |
| 23831 | 0.004 |
| 23832 | 0.002 |
| 23833 | 0.004 |
| 23834 | 0.006 |
| 23835 | 0.002 |
| 23836 | 0.004 |
| 23837 | 0.002 |
| 23838 | 0.007 |
| 23839 | 0.006 |
| 23840 | 0.006 |
| 23841 | 0.005 |
| 23842 | 0.005 |
| 23843 | 0.009 |
| 23844 | 0.007 |
| 23845 | 0.005 |
| 23846 | 0.002 |
| 23847 | 0.005 |
| 23848 | 0.008 |
| 23849 | 0.004 |
| 23850 | 0.001 |
| 23851 | 0.001 |
| 23852 | 0.005 |
| 23853 | 0.007 |
| 23854 | 0.006 |
| 23855 | 0.007 |
| 23856 | 0.005 |
| 23857 | 0.009 |
| 23858 | 0.002 |
| 23859 | 0.005 |
| 23860 | 0.002 |
| 23861 | 0.003 |
| 23862 | 0.006 |
| 23863 | 0.007 |
| 23864 | 0.004 |
| 23865 | 0.005 |
| 23866 | 0.002 |
| 23867 | 0.002 |
| 23868 | 0.004 |
| 23869 | 0.005 |
| 23870 | 0.006 |
| 23871 | 0.006 |
| 23872 | 0.005 |
| 23873 | 0.006 |
| 23874 | 0.008 |
| 23875 | 0.004 |
| 23876 | 0.007 |
| 23877 | 0.008 |
| 23878 | 0.004 |
| 23879 | 0.005 |
| 23880 | 0.004 |
| 23881 | 0.006 |
| 23882 | 0.007 |
| 23883 | 0.003 |
| 23884 | 0.006 |
| 23885 | 0.009 |
| 23886 | 0.002 |
| 23887 | 0.004 |
| 23888 | 0.006 |
| 23889 | 0.01 |
| 23890 | 0.002 |
| 23891 | 0.004 |
| 23892 | 0.002 |
| 23893 | 0.002 |
| 23894 | 0.003 |
| 23895 | 0.001 |
| 23896 | 0.011 |
| 23897 | 0.012 |
| 23898 | 0.002 |
| 23899 | 0.003 |
| 23900 | 0.001 |
| 23901 | 0.007 |
| 23902 | 0.003 |
| 23903 | 0.006 |
| 23904 | 0.001 |
| 23905 | 0.007 |
| 23906 | 0.003 |
| 23907 | 0.002 |
| 23908 | 0.001 |
| 23909 | 0.006 |
| 23910 | 0.002 |
| 23911 | 0.009 |
| 23912 | 0.009 |
| 23913 | 0.008 |
| 23914 | 0.003 |
| 23915 | 0.003 |
| 23916 | 0.006 |
| 23917 | 0.002 |
| 23918 | 0.005 |
| 23919 | 0.003 |
| 23920 | 0.006 |
| 23921 | 0.007 |
| 23922 | 0.002 |
| 23923 | 0.003 |
| 23924 | 0.006 |
| 23925 | 0.003 |
| 23926 | 0.002 |
| 23927 | 0.004 |
| 23928 | 0.003 |
| 23929 | 0.004 |
| 23930 | 0.004 |
| 23931 | 0.004 |
| 23932 | 0.006 |
| 23933 | 0.005 |
| 23934 | 0.002 |
| 23935 | 0.003 |
| 23936 | 0.002 |
| 23937 | 0.001 |
| 23938 | 0.01 |
| 23939 | 0.009 |
| 23940 | 0.012 |
| 23941 | 0.002 |
| 23942 | 0.002 |
| 23943 | 0.005 |
| 23944 | 0.004 |
| 23945 | 0.004 |
| 23946 | 0.006 |
| 23947 | 0.012 |
| 23948 | 0.003 |
| 23949 | 0.003 |
| 23950 | 0.002 |
| 23951 | 0.007 |
| 23952 | 0.006 |
| 23953 | 0.003 |
| 23954 | 0.002 |
| 23955 | 0.004 |
| 23956 | 0.006 |
| 23957 | 0.001 |
| 23958 | 0.002 |
| 23959 | 0.002 |
| 23960 | 0.002 |
| 23961 | 0.001 |
| 23962 | 0.003 |
| 23963 | 0.008 |
| 23964 | 0.004 |
| 23965 | 0 |
| 23966 | 0.007 |
| 23967 | 0.009 |
| 23968 | 0.005 |
| 23969 | 0.002 |
| 23970 | 0.002 |
| 23971 | 0.001 |
| 23972 | 0.003 |
| 23973 | 0.002 |
| 23974 | 0.003 |
| 23975 | 0.005 |
| 23976 | 0.007 |
| 23977 | 0.002 |
| 23978 | 0.002 |
| 23979 | 0.004 |
| 23980 | 0.001 |
| 23981 | 0.005 |
| 23982 | 0.01 |
| 23983 | 0.004 |
| 23984 | 0.007 |
| 23985 | 0.006 |
| 23986 | 0.001 |
| 23987 | 0.001 |
| 23988 | 0.006 |
| 23989 | 0.006 |
| 23990 | 0.002 |
| 23991 | 0.002 |
| 23992 | 0.009 |
| 23993 | 0.001 |
| 23994 | 0.001 |
| 23995 | 0.002 |
| 23996 | 0.004 |
| 23997 | 0.003 |
| 23998 | 0.003 |
| 23999 | 0.002 |
| 24000 | 0.003 |
| 24001 | 0.005 |
| 24002 | 0.003 |
| 24003 | 0.004 |
| 24004 | 0.004 |
| 24005 | 0.006 |
| 24006 | 0.001 |
| 24007 | 0.005 |
| 24008 | 0.003 |
| 24009 | 0.003 |
| 24010 | 0.006 |
| 24011 | 0.003 |
| 24012 | 0.005 |
| 24013 | 0.001 |
| 24014 | 0.002 |
| 24015 | 0.004 |
| 24016 | 0.004 |
| 24017 | 0.004 |
| 24018 | 0.009 |
| 24019 | 0.006 |
| 24020 | 0.005 |
| 24021 | 0.003 |
| 24022 | 0.002 |
| 24023 | 0.004 |
| 24024 | 0.007 |
| 24025 | 0.004 |
| 24026 | 0.002 |
| 24027 | 0.002 |
| 24028 | 0.002 |
| 24029 | 0.003 |
| 24030 | 0.002 |
| 24031 | 0.007 |
| 24032 | 0.008 |
| 24033 | 0.001 |
| 24034 | 0.001 |
| 24035 | 0.002 |
| 24036 | 0.003 |
| 24037 | 0.003 |
| 24038 | 0.003 |
| 24039 | 0.013 |
| 24040 | 0.008 |
| 24041 | 0.002 |
| 24042 | 0.003 |
| 24043 | 0.002 |
| 24044 | 0.005 |
| 24045 | 0.008 |
| 24046 | 0.003 |
| 24047 | 0.002 |
| 24048 | 0.005 |
| 24049 | 0.005 |
| 24050 | 0.006 |
| 24051 | 0.003 |
| 24052 | 0.001 |
| 24053 | 0.001 |
| 24054 | 0.003 |
| 24055 | 0.003 |
| 24056 | 0.006 |
| 24057 | 0.004 |
| 24058 | 0.001 |
| 24059 | 0.001 |
| 24060 | 0.009 |
| 24061 | 0.003 |
| 24062 | 0.002 |
| 24063 | 0.002 |
| 24064 | 0.005 |
| 24065 | 0.004 |
| 24066 | 0.002 |
| 24067 | 0.004 |
| 24068 | 0.004 |
| 24069 | 0.006 |
| 24070 | 0.005 |
| 24071 | 0.003 |
| 24072 | 0.003 |
| 24073 | 0.005 |
| 24074 | 0.002 |
| 24075 | 0.001 |
| 24076 | 0.002 |
| 24077 | 0.003 |
| 24078 | 0.002 |
| 24079 | 0.004 |
| 24080 | 0.006 |
| 24081 | 0.008 |
| 24082 | 0.001 |
| 24083 | 0.002 |
| 24084 | 0.004 |
| 24085 | 0.004 |
| 24086 | 0.002 |
| 24087 | 0.001 |
| 24088 | 0.004 |
| 24089 | 0.003 |
| 24090 | 0.002 |
| 24091 | 0.002 |
| 24092 | 0.004 |
| 24093 | 0.007 |
| 24094 | 0.002 |
| 24095 | 0.002 |
| 24096 | 0.003 |
| 24097 | 0.005 |
| 24098 | 0.001 |
| 24099 | 0.003 |
| 24100 | 0.001 |
| 24101 | 0.002 |
| 24102 | 0.003 |
| 24103 | 0.002 |
| 24104 | 0.002 |
| 24105 | 0.007 |
| 24106 | 0.005 |
| 24107 | 0.005 |
| 24108 | 0.003 |
| 24109 | 0.003 |
| 24110 | 0.004 |
| 24111 | 0.009 |
| 24112 | 0.005 |
| 24113 | 0.004 |
| 24114 | 0.004 |
| 24115 | 0.003 |
| 24116 | 0.006 |
| 24117 | 0.005 |
| 24118 | 0.005 |
| 24119 | 0.003 |
| 24120 | 0.003 |
| 24121 | 0.003 |
| 24122 | 0.003 |
| 24123 | 0.005 |
| 24124 | 0.007 |
| 24125 | 0.006 |
| 24126 | 0.004 |
| 24127 | 0.006 |
| 24128 | 0.005 |
| 24129 | 0.008 |
| 24130 | 0.006 |
| 24131 | 0.007 |
| 24132 | 0.006 |
| 24133 | 0.003 |
| 24134 | 0.004 |
| 24135 | 0.003 |
| 24136 | 0.004 |
| 24137 | 0.003 |
| 24138 | 0.002 |
| 24139 | 0.003 |
| 24140 | 0.004 |
| 24141 | 0.008 |
| 24142 | 0.002 |
| 24143 | 0.006 |
| 24144 | 0.006 |
| 24145 | 0.004 |
| 24146 | 0.003 |
| 24147 | 0.003 |
| 24148 | 0.005 |
| 24149 | 0.005 |
| 24150 | 0.005 |
| 24151 | 0.011 |
| 24152 | 0.006 |
| 24153 | 0.002 |
| 24154 | 0.004 |
| 24155 | 0.004 |
| 24156 | 0.004 |
| 24157 | 0.002 |
| 24158 | 0.009 |
| 24159 | 0.004 |
| 24160 | 0.007 |
| 24161 | 0.002 |
| 24162 | 0.004 |
| 24163 | 0.004 |
| 24164 | 0.005 |
| 24165 | 0.006 |
| 24166 | 0.006 |
| 24167 | 0.003 |
| 24168 | 0.003 |
| 24169 | 0.006 |
| 24170 | 0.005 |
| 24171 | 0.007 |
| 24172 | 0.007 |
| 24173 | 0.006 |
| 24174 | 0.001 |
| 24175 | 0.004 |
| 24176 | 0.005 |
| 24177 | 0.004 |
| 24178 | 0.003 |
| 24179 | 0.003 |
| 24180 | 0.004 |
| 24181 | 0.008 |
| 24182 | 0.004 |
| 24183 | 0.003 |
| 24184 | 0.007 |
| 24185 | 0.009 |
| 24186 | 0.002 |
| 24187 | 0.003 |
| 24188 | 0.005 |
| 24189 | 0.001 |
| 24190 | 0.003 |
| 24191 | 0.003 |
| 24192 | 0.004 |
| 24193 | 0.002 |
| 24194 | 0.002 |
| 24195 | 0.004 |
| 24196 | 0.004 |
| 24197 | 0.005 |
| 24198 | 0.005 |
| 24199 | 0.005 |
| 24200 | 0.006 |
| 24201 | 0.003 |
| 24202 | 0.004 |
| 24203 | 0.004 |
| 24204 | 0.006 |
| 24205 | 0.006 |
| 24206 | 0.003 |
| 24207 | 0.003 |
| 24208 | 0.006 |
| 24209 | 0.003 |
| 24210 | 0.002 |
| 24211 | 0.004 |
| 24212 | 0.004 |
| 24213 | 0.002 |
| 24214 | 0.002 |
| 24215 | 0.002 |
| 24216 | 0.004 |
| 24217 | 0.002 |
| 24218 | 0.002 |
| 24219 | 0.008 |
| 24220 | 0.003 |
| 24221 | 0.002 |
| 24222 | 0.002 |
| 24223 | 0.003 |
| 24224 | 0.007 |
| 24225 | 0.002 |
| 24226 | 0.005 |
| 24227 | 0.006 |
| 24228 | 0.002 |
| 24229 | 0.003 |
| 24230 | 0.007 |
| 24231 | 0.006 |
| 24232 | 0.003 |
| 24233 | 0.005 |
| 24234 | 0.002 |
| 24235 | 0.006 |
| 24236 | 0.009 |
| 24237 | 0.002 |
| 24238 | 0.005 |
| 24239 | 0.005 |
| 24240 | 0.002 |
| 24241 | 0.001 |
| 24242 | 0.003 |
| 24243 | 0.005 |
| 24244 | 0.01 |
| 24245 | 0.002 |
| 24246 | 0.003 |
| 24247 | 0.001 |
| 24248 | 0.004 |
| 24249 | 0.002 |
| 24250 | 0.002 |
| 24251 | 0.008 |
| 24252 | 0.001 |
| 24253 | 0.002 |
| 24254 | 0.004 |
| 24255 | 0.007 |
| 24256 | 0.007 |
| 24257 | 0.003 |
| 24258 | 0.009 |
| 24259 | 0.01 |
| 24260 | 0.003 |
| 24261 | 0.002 |
| 24262 | 0.005 |
| 24263 | 0.005 |
| 24264 | 0.007 |
| 24265 | 0.001 |
| 24266 | 0.003 |
| 24267 | 0.003 |
| 24268 | 0.001 |
| 24269 | 0.005 |
| 24270 | 0.003 |
| 24271 | 0.007 |
| 24272 | 0.003 |
| 24273 | 0.003 |
| 24274 | 0.002 |
| 24275 | 0.003 |
| 24276 | 0.004 |
| 24277 | 0.004 |
| 24278 | 0.003 |
| 24279 | 0.008 |
| 24280 | 0.008 |
| 24281 | 0.002 |
| 24282 | 0.006 |
| 24283 | 0.004 |
| 24284 | 0.005 |
| 24285 | 0.003 |
| 24286 | 0.004 |
| 24287 | 0.008 |
| 24288 | 0.006 |
| 24289 | 0.003 |
| 24290 | 0 |
| 24291 | 0.002 |
| 24292 | 0.003 |
| 24293 | 0.002 |
| 24294 | 0.003 |
| 24295 | 0.005 |
| 24296 | 0.009 |
| 24297 | 0.003 |
| 24298 | 0.008 |
| 24299 | 0.012 |
| 24300 | 0.011 |
| 24301 | 0.004 |
| 24302 | 0.004 |
| 24303 | 0.003 |
| 24304 | 0.005 |
| 24305 | 0.003 |
| 24306 | 0.002 |
| 24307 | 0.005 |
| 24308 | 0.002 |
| 24309 | 0.001 |
| 24310 | 0.005 |
| 24311 | 0.003 |
| 24312 | 0.002 |
| 24313 | 0.005 |
| 24314 | 0.005 |
| 24315 | 0.003 |
| 24316 | 0.005 |
| 24317 | 0.004 |
| 24318 | 0.002 |
| 24319 | 0.003 |
| 24320 | 0.005 |
| 24321 | 0.003 |
| 24322 | 0.001 |
| 24323 | 0.006 |
| 24324 | 0.004 |
| 24325 | 0.002 |
| 24326 | 0.002 |
| 24327 | 0.005 |
| 24328 | 0.008 |
| 24329 | 0.007 |
| 24330 | 0.002 |
| 24331 | 0.006 |
| 24332 | 0.007 |
| 24333 | 0.003 |
| 24334 | 0.003 |
| 24335 | 0.002 |
| 24336 | 0.005 |
| 24337 | 0.008 |
| 24338 | 0.004 |
| 24339 | 0.005 |
| 24340 | 0.003 |
| 24341 | 0.003 |
| 24342 | 0.003 |
| 24343 | 0.005 |
| 24344 | 0.002 |
| 24345 | 0.002 |
| 24346 | 0.003 |
| 24347 | 0.004 |
| 24348 | 0.004 |
| 24349 | 0.002 |
| 24350 | 0.002 |
| 24351 | 0.002 |
| 24352 | 0.002 |
| 24353 | 0.002 |
| 24354 | 0.001 |
| 24355 | 0.008 |
| 24356 | 0.002 |
| 24357 | 0.007 |
| 24358 | 0.008 |
| 24359 | 0.009 |
| 24360 | 0.006 |
| 24361 | 0.004 |
| 24362 | 0.003 |
| 24363 | 0.004 |
| 24364 | 0.001 |
| 24365 | 0.001 |
| 24366 | 0.003 |
| 24367 | 0.004 |
| 24368 | 0.005 |
| 24369 | 0.004 |
| 24370 | 0.002 |
| 24371 | 0.001 |
| 24372 | 0.003 |
| 24373 | 0.005 |
| 24374 | 0.003 |
| 24375 | 0.005 |
| 24376 | 0.005 |
| 24377 | 0.004 |
| 24378 | 0.002 |
| 24379 | 0.003 |
| 24380 | 0.003 |
| 24381 | 0.005 |
| 24382 | 0.001 |
| 24383 | 0.002 |
| 24384 | 0.004 |
| 24385 | 0.003 |
| 24386 | 0.003 |
| 24387 | 0.012 |
| 24388 | 0.009 |
| 24389 | 0.007 |
| 24390 | 0.003 |
| 24391 | 0.003 |
| 24392 | 0.01 |
| 24393 | 0.005 |
| 24394 | 0.005 |
| 24395 | 0.001 |
| 24396 | 0.003 |
| 24397 | 0.002 |
| 24398 | 0.002 |
| 24399 | 0.009 |
| 24400 | 0.003 |
| 24401 | 0.005 |
| 24402 | 0.001 |
| 24403 | 0.007 |
| 24404 | 0.003 |
| 24405 | 0.001 |
| 24406 | 0.003 |
| 24407 | 0.002 |
| 24408 | 0.001 |
| 24409 | 0.002 |
| 24410 | 0.001 |
| 24411 | 0.004 |
| 24412 | 0.003 |
| 24413 | 0.002 |
| 24414 | 0.005 |
| 24415 | 0.003 |
| 24416 | 0.007 |
| 24417 | 0.002 |
| 24418 | 0.005 |
| 24419 | 0.005 |
| 24420 | 0.005 |
| 24421 | 0.005 |
| 24422 | 0.007 |
| 24423 | 0.004 |
| 24424 | 0.004 |
| 24425 | 0.003 |
| 24426 | 0.003 |
| 24427 | 0 |
| 24428 | 0.003 |
| 24429 | 0.003 |
| 24430 | 0.006 |
| 24431 | 0.01 |
| 24432 | 0.01 |
| 24433 | 0.006 |
| 24434 | 0.007 |
| 24435 | 0.008 |
| 24436 | 0.004 |
| 24437 | 0.005 |
| 24438 | 0.003 |
| 24439 | 0.008 |
| 24440 | 0.003 |
| 24441 | 0.002 |
| 24442 | 0.005 |
| 24443 | 0.007 |
| 24444 | 0.003 |
| 24445 | 0.002 |
| 24446 | 0.005 |
| 24447 | 0.004 |
| 24448 | 0.001 |
| 24449 | 0.004 |
| 24450 | 0.001 |
| 24451 | 0.003 |
| 24452 | 0.004 |
| 24453 | 0.012 |
| 24454 | 0.007 |
| 24455 | 0.008 |
| 24456 | 0.01 |
| 24457 | 0.008 |
| 24458 | 0.005 |
| 24459 | 0.005 |
| 24460 | 0.009 |
| 24461 | 0.005 |
| 24462 | 0.006 |
| 24463 | 0.008 |
| 24464 | 0.002 |
| 24465 | 0.003 |
| 24466 | 0.003 |
| 24467 | 0.003 |
| 24468 | 0.002 |
| 24469 | 0.003 |
| 24470 | 0.003 |
| 24471 | 0.004 |
| 24472 | 0.005 |
| 24473 | 0.005 |
| 24474 | 0.002 |
| 24475 | 0.001 |
| 24476 | 0.003 |
| 24477 | 0.002 |
| 24478 | 0.004 |
| 24479 | 0.002 |
| 24480 | 0.011 |
| 24481 | 0.007 |
| 24482 | 0.002 |
| 24483 | 0.004 |
| 24484 | 0.002 |
| 24485 | 0.009 |
| 24486 | 0.003 |
| 24487 | 0.006 |
| 24488 | 0.004 |
| 24489 | 0.001 |
| 24490 | 0.003 |
| 24491 | 0.005 |
| 24492 | 0.01 |
| 24493 | 0.012 |
| 24494 | 0.004 |
| 24495 | 0.004 |
| 24496 | 0.002 |
| 24497 | 0.005 |
| 24498 | 0.002 |
| 24499 | 0.003 |
| 24500 | 0.008 |
| 24501 | 0.005 |
| 24502 | 0.002 |
| 24503 | 0.002 |
| 24504 | 0.003 |
| 24505 | 0.006 |
| 24506 | 0.005 |
| 24507 | 0.003 |
| 24508 | 0.005 |
| 24509 | 0.003 |
| 24510 | 0.002 |
| 24511 | 0.002 |
| 24512 | 0.002 |
| 24513 | 0.007 |
| 24514 | 0.002 |
| 24515 | 0.003 |
| 24516 | 0.005 |
| 24517 | 0.004 |
| 24518 | 0.002 |
| 24519 | 0.002 |
| 24520 | 0.004 |
| 24521 | 0.007 |
| 24522 | 0.003 |
| 24523 | 0.003 |
| 24524 | 0.008 |
| 24525 | 0.012 |
| 24526 | 0.003 |
| 24527 | 0.003 |
| 24528 | 0.009 |
| 24529 | 0.006 |
| 24530 | 0.003 |
| 24531 | 0.004 |
| 24532 | 0.003 |
| 24533 | 0.006 |
| 24534 | 0.001 |
| 24535 | 0.005 |
| 24536 | 0.009 |
| 24537 | 0.008 |
| 24538 | 0.001 |
| 24539 | 0.003 |
| 24540 | 0.003 |
| 24541 | 0.004 |
| 24542 | 0.002 |
| 24543 | 0.004 |
| 24544 | 0.004 |
| 24545 | 0.004 |
| 24546 | 0.008 |
| 24547 | 0.004 |
| 24548 | 0.004 |
| 24549 | 0.002 |
| 24550 | 0.006 |
| 24551 | 0.009 |
| 24552 | 0.004 |
| 24553 | 0.002 |
| 24554 | 0.003 |
| 24555 | 0.003 |
| 24556 | 0.007 |
| 24557 | 0.003 |
| 24558 | 0.002 |
| 24559 | 0.006 |
| 24560 | 0.009 |
| 24561 | 0.002 |
| 24562 | 0.003 |
| 24563 | 0.007 |
| 24564 | 0.004 |
| 24565 | 0.002 |
| 24566 | 0.002 |
| 24567 | 0.006 |
| 24568 | 0.004 |
| 24569 | 0.002 |
| 24570 | 0.003 |
| 24571 | 0.003 |
| 24572 | 0.006 |
| 24573 | 0.004 |
| 24574 | 0.005 |
| 24575 | 0.004 |
| 24576 | 0.002 |
| 24577 | 0.001 |
| 24578 | 0.01 |
| 24579 | 0.009 |
| 24580 | 0.007 |
| 24581 | 0.001 |
| 24582 | 0.006 |
| 24583 | 0.009 |
| 24584 | 0.007 |
| 24585 | 0.002 |
| 24586 | 0.002 |
| 24587 | 0.003 |
| 24588 | 0.007 |
| 24589 | 0.001 |
| 24590 | 0.003 |
| 24591 | 0.003 |
| 24592 | 0.007 |
| 24593 | 0.006 |
| 24594 | 0.003 |
| 24595 | 0.007 |
| 24596 | 0.001 |
| 24597 | 0.004 |
| 24598 | 0.002 |
| 24599 | 0.003 |
| 24600 | 0.009 |
| 24601 | 0.008 |
| 24602 | 0.001 |
| 24603 | 0.002 |
| 24604 | 0.003 |
| 24605 | 0.002 |
| 24606 | 0.002 |
| 24607 | 0.001 |
| 24608 | 0.006 |
| 24609 | 0.005 |
| 24610 | 0.001 |
| 24611 | 0.004 |
| 24612 | 0.003 |
| 24613 | 0.003 |
| 24614 | 0.002 |
| 24615 | 0.005 |
| 24616 | 0.005 |
| 24617 | 0.002 |
| 24618 | 0.001 |
| 24619 | 0.003 |
| 24620 | 0.004 |
| 24621 | 0.004 |
| 24622 | 0.002 |
| 24623 | 0.007 |
| 24624 | 0.011 |
| 24625 | 0.003 |
| 24626 | 0.003 |
| 24627 | 0.007 |
| 24628 | 0.003 |
| 24629 | 0.005 |
| 24630 | 0.004 |
| 24631 | 0.006 |
| 24632 | 0.003 |
| 24633 | 0.003 |
| 24634 | 0.001 |
| 24635 | 0.006 |
| 24636 | 0.01 |
| 24637 | 0.002 |
| 24638 | 0.002 |
| 24639 | 0.005 |
| 24640 | 0.002 |
| 24641 | 0.001 |
| 24642 | 0.008 |
| 24643 | 0.002 |
| 24644 | 0.004 |
| 24645 | 0.002 |
| 24646 | 0.003 |
| 24647 | 0.006 |
| 24648 | 0.004 |
| 24649 | 0.006 |
| 24650 | 0.002 |
| 24651 | 0.004 |
| 24652 | 0.008 |
| 24653 | 0.002 |
| 24654 | 0.002 |
| 24655 | 0.006 |
| 24656 | 0.006 |
| 24657 | 0.003 |
| 24658 | 0.004 |
| 24659 | 0.005 |
| 24660 | 0.007 |
| 24661 | 0.002 |
| 24662 | 0.004 |
| 24663 | 0.007 |
| 24664 | 0.004 |
| 24665 | 0.002 |
| 24666 | 0.004 |
| 24667 | 0.009 |
| 24668 | 0.01 |
| 24669 | 0.006 |
| 24670 | 0.008 |
| 24671 | 0.007 |
| 24672 | 0.005 |
| 24673 | 0.003 |
| 24674 | 0.005 |
| 24675 | 0.004 |
| 24676 | 0.006 |
| 24677 | 0.001 |
| 24678 | 0.005 |
| 24679 | 0.004 |
| 24680 | 0.004 |
| 24681 | 0.003 |
| 24682 | 0.004 |
| 24683 | 0.004 |
| 24684 | 0.004 |
| 24685 | 0.01 |
| 24686 | 0.001 |
| 24687 | 0.002 |
| 24688 | 0.009 |
| 24689 | 0.007 |
| 24690 | 0.002 |
| 24691 | 0.002 |
| 24692 | 0.003 |
| 24693 | 0.002 |
| 24694 | 0.005 |
| 24695 | 0.003 |
| 24696 | 0.002 |
| 24697 | 0.002 |
| 24698 | 0.003 |
| 24699 | 0.008 |
| 24700 | 0.002 |
| 24701 | 0.004 |
| 24702 | 0.002 |
| 24703 | 0.008 |
| 24704 | 0.007 |
| 24705 | 0.006 |
| 24706 | 0.004 |
| 24707 | 0.002 |
| 24708 | 0.007 |
| 24709 | 0.005 |
| 24710 | 0.002 |
| 24711 | 0.003 |
| 24712 | 0.005 |
| 24713 | 0.004 |
| 24714 | 0.002 |
| 24715 | 0.001 |
| 24716 | 0.001 |
| 24717 | 0.002 |
| 24718 | 0.008 |
| 24719 | 0.001 |
| 24720 | 0.003 |
| 24721 | 0.009 |
| 24722 | 0.002 |
| 24723 | 0.006 |
| 24724 | 0.009 |
| 24725 | 0.006 |
| 24726 | 0.001 |
| 24727 | 0.002 |
| 24728 | 0.002 |
| 24729 | 0.002 |
| 24730 | 0.001 |
| 24731 | 0.005 |
| 24732 | 0.008 |
| 24733 | 0.01 |
| 24734 | 0.004 |
| 24735 | 0.003 |
| 24736 | 0.005 |
| 24737 | 0.002 |
| 24738 | 0.006 |
| 24739 | 0.002 |
| 24740 | 0.005 |
| 24741 | 0.004 |
| 24742 | 0.007 |
| 24743 | 0.003 |
| 24744 | 0.005 |
| 24745 | 0.006 |
| 24746 | 0.007 |
| 24747 | 0.003 |
| 24748 | 0.004 |
| 24749 | 0.001 |
| 24750 | 0.003 |
| 24751 | 0.006 |
| 24752 | 0.005 |
| 24753 | 0.002 |
| 24754 | 0.006 |
| 24755 | 0.005 |
| 24756 | 0.009 |
| 24757 | 0.009 |
| 24758 | 0.003 |
| 24759 | 0.006 |
| 24760 | 0.007 |
| 24761 | 0.012 |
| 24762 | 0.003 |
| 24763 | 0.003 |
| 24764 | 0.003 |
| 24765 | 0.002 |
| 24766 | 0.005 |
| 24767 | 0.003 |
| 24768 | 0.004 |
| 24769 | 0.005 |
| 24770 | 0.002 |
| 24771 | 0.004 |
| 24772 | 0.004 |
| 24773 | 0.001 |
| 24774 | 0.004 |
| 24775 | 0.01 |
| 24776 | 0.011 |
| 24777 | 0.004 |
| 24778 | 0.002 |
| 24779 | 0.002 |
| 24780 | 0.006 |
| 24781 | 0.002 |
| 24782 | 0.004 |
| 24783 | 0.003 |
| 24784 | 0.005 |
| 24785 | 0.005 |
| 24786 | 0.006 |
| 24787 | 0.008 |
| 24788 | 0.005 |
| 24789 | 0.005 |
| 24790 | 0.002 |
| 24791 | 0.003 |
| 24792 | 0.004 |
| 24793 | 0.003 |
| 24794 | 0.003 |
| 24795 | 0.003 |
| 24796 | 0.007 |
| 24797 | 0.002 |
| 24798 | 0.006 |
| 24799 | 0.005 |
| 24800 | 0.006 |
| 24801 | 0.003 |
| 24802 | 0.004 |
| 24803 | 0.009 |
| 24804 | 0.006 |
| 24805 | 0.001 |
| 24806 | 0.003 |
| 24807 | 0.009 |
| 24808 | 0.011 |
| 24809 | 0.003 |
| 24810 | 0.003 |
| 24811 | 0.007 |
| 24812 | 0.008 |
| 24813 | 0.005 |
| 24814 | 0.009 |
| 24815 | 0.011 |
| 24816 | 0.006 |
| 24817 | 0.002 |
| 24818 | 0.004 |
| 24819 | 0.003 |
| 24820 | 0.004 |
| 24821 | 0.003 |
| 24822 | 0.002 |
| 24823 | 0.001 |
| 24824 | 0.005 |
| 24825 | 0.005 |
| 24826 | 0.002 |
| 24827 | 0.002 |
| 24828 | 0.004 |
| 24829 | 0.002 |
| 24830 | 0.001 |
| 24831 | 0.006 |
| 24832 | 0.008 |
| 24833 | 0.001 |
| 24834 | 0.003 |
| 24835 | 0.006 |
| 24836 | 0.006 |
| 24837 | 0.004 |
| 24838 | 0.005 |
| 24839 | 0.011 |
| 24840 | 0.001 |
| 24841 | 0.005 |
| 24842 | 0.006 |
| 24843 | 0.009 |
| 24844 | 0.007 |
| 24845 | 0.004 |
| 24846 | 0.002 |
| 24847 | 0.004 |
| 24848 | 0.004 |
| 24849 | 0.002 |
| 24850 | 0.008 |
| 24851 | 0.012 |
| 24852 | 0.013 |
| 24853 | 0.005 |
| 24854 | 0.002 |
| 24855 | 0.008 |
| 24856 | 0.006 |
| 24857 | 0.003 |
| 24858 | 0.002 |
| 24859 | 0.004 |
| 24860 | 0.006 |
| 24861 | 0.003 |
| 24862 | 0.002 |
| 24863 | 0.012 |
| 24864 | 0.007 |
| 24865 | 0.003 |
| 24866 | 0.005 |
| 24867 | 0.007 |
| 24868 | 0.001 |
| 24869 | 0.002 |
| 24870 | 0.007 |
| 24871 | 0.006 |
| 24872 | 0.004 |
| 24873 | 0.002 |
| 24874 | 0.007 |
| 24875 | 0.008 |
| 24876 | 0.004 |
| 24877 | 0.002 |
| 24878 | 0.002 |
| 24879 | 0.001 |
| 24880 | 0.005 |
| 24881 | 0.003 |
| 24882 | 0.003 |
| 24883 | 0.005 |
| 24884 | 0.004 |
| 24885 | 0.003 |
| 24886 | 0.006 |
| 24887 | 0.008 |
| 24888 | 0.008 |
| 24889 | 0.001 |
| 24890 | 0.003 |
| 24891 | 0.003 |
| 24892 | 0.009 |
| 24893 | 0.006 |
| 24894 | 0.003 |
| 24895 | 0.005 |
| 24896 | 0.007 |
| 24897 | 0.002 |
| 24898 | 0.002 |
| 24899 | 0.005 |
| 24900 | 0.006 |
| 24901 | 0.004 |
| 24902 | 0.002 |
| 24903 | 0.002 |
| 24904 | 0.003 |
| 24905 | 0.001 |
| 24906 | 0.003 |
| 24907 | 0.006 |
| 24908 | 0.006 |
| 24909 | 0.003 |
| 24910 | 0.003 |
| 24911 | 0.004 |
| 24912 | 0.003 |
| 24913 | 0.01 |
| 24914 | 0.002 |
| 24915 | 0.003 |
| 24916 | 0.006 |
| 24917 | 0.007 |
| 24918 | 0.004 |
| 24919 | 0.004 |
| 24920 | 0.002 |
| 24921 | 0.005 |
| 24922 | 0.003 |
| 24923 | 0.002 |
| 24924 | 0.005 |
| 24925 | 0.005 |
| 24926 | 0.001 |
| 24927 | 0.002 |
| 24928 | 0.005 |
| 24929 | 0.003 |
| 24930 | 0.007 |
| 24931 | 0.002 |
| 24932 | 0.008 |
| 24933 | 0.007 |
| 24934 | 0.005 |
| 24935 | 0.004 |
| 24936 | 0.004 |
| 24937 | 0.008 |
| 24938 | 0.002 |
| 24939 | 0.004 |
| 24940 | 0.008 |
| 24941 | 0.007 |
| 24942 | 0.003 |
| 24943 | 0.006 |
| 24944 | 0.003 |
| 24945 | 0.008 |
| 24946 | 0.001 |
| 24947 | 0.002 |
| 24948 | 0.004 |
| 24949 | 0.006 |
| 24950 | 0.002 |
| 24951 | 0.002 |
| 24952 | 0.007 |
| 24953 | 0.004 |
| 24954 | 0.001 |
| 24955 | 0.002 |
| 24956 | 0.005 |
| 24957 | 0.005 |
| 24958 | 0.002 |
| 24959 | 0.003 |
| 24960 | 0.004 |
| 24961 | 0.002 |
| 24962 | 0.006 |
| 24963 | 0.004 |
| 24964 | 0.002 |
| 24965 | 0.001 |
| 24966 | 0.004 |
| 24967 | 0.002 |
| 24968 | 0.005 |
| 24969 | 0.007 |
| 24970 | 0.003 |
| 24971 | 0.002 |
| 24972 | 0.002 |
| 24973 | 0.004 |
| 24974 | 0.003 |
| 24975 | 0.003 |
| 24976 | 0.004 |
| 24977 | 0.002 |
| 24978 | 0.003 |
| 24979 | 0.003 |
| 24980 | 0.003 |
| 24981 | 0.004 |
| 24982 | 0.002 |
| 24983 | 0.003 |
| 24984 | 0.006 |
| 24985 | 0.01 |
| 24986 | 0.006 |
| 24987 | 0.004 |
| 24988 | 0.003 |
| 24989 | 0.003 |
| 24990 | 0.002 |
| 24991 | 0.006 |
| 24992 | 0.002 |
| 24993 | 0.006 |
| 24994 | 0.005 |
| 24995 | 0.009 |
| 24996 | 0.003 |
| 24997 | 0.007 |
| 24998 | 0.006 |
| 24999 | 0.004 |
| 25000 | 0.004 |
| 25001 | 0.004 |
| 25002 | 0.006 |
| 25003 | 0.006 |
| 25004 | 0.006 |
| 25005 | 0.008 |
| 25006 | 0.004 |
| 25007 | 0.005 |
| 25008 | 0.007 |
| 25009 | 0.005 |
| 25010 | 0.006 |
| 25011 | 0.005 |
| 25012 | 0.005 |
| 25013 | 0.007 |
| 25014 | 0.003 |
| 25015 | 0.005 |
| 25016 | 0.003 |
| 25017 | 0.005 |
| 25018 | 0.002 |
| 25019 | 0.006 |
| 25020 | 0.007 |
| 25021 | 0.002 |
| 25022 | 0.005 |
| 25023 | 0.002 |
| 25024 | 0.008 |
| 25025 | 0.004 |
| 25026 | 0.005 |
| 25027 | 0.006 |
| 25028 | 0.007 |
| 25029 | 0.003 |
| 25030 | 0.003 |
| 25031 | 0.005 |
| 25032 | 0.003 |
| 25033 | 0.003 |
| 25034 | 0.004 |
| 25035 | 0.005 |
| 25036 | 0.006 |
| 25037 | 0.004 |
| 25038 | 0.005 |
| 25039 | 0.005 |
| 25040 | 0.004 |
| 25041 | 0.004 |
| 25042 | 0.005 |
| 25043 | 0.006 |
| 25044 | 0.005 |
| 25045 | 0.003 |
| 25046 | 0.004 |
| 25047 | 0.002 |
| 25048 | 0.004 |
| 25049 | 0.007 |
| 25050 | 0.006 |
| 25051 | 0.002 |
| 25052 | 0.006 |
| 25053 | 0.006 |
| 25054 | 0.005 |
| 25055 | 0.004 |
| 25056 | 0.003 |
| 25057 | 0.005 |
| 25058 | 0.004 |
| 25059 | 0.006 |
| 25060 | 0.007 |
| 25061 | 0.007 |
| 25062 | 0.009 |
| 25063 | 0.004 |
| 25064 | 0.004 |
| 25065 | 0.004 |
| 25066 | 0.006 |
| 25067 | 0.003 |
| 25068 | 0.006 |
| 25069 | 0.008 |
| 25070 | 0.003 |
| 25071 | 0.002 |
| 25072 | 0.005 |
| 25073 | 0.004 |
| 25074 | 0.004 |
| 25075 | 0.004 |
| 25076 | 0.007 |
| 25077 | 0.006 |
| 25078 | 0.003 |
| 25079 | 0.003 |
| 25080 | 0.004 |
| 25081 | 0.005 |
| 25082 | 0.004 |
| 25083 | 0.005 |
| 25084 | 0.007 |
| 25085 | 0.004 |
| 25086 | 0.002 |
| 25087 | 0.004 |
| 25088 | 0.004 |
| 25089 | 0.009 |
| 25090 | 0.004 |
| 25091 | 0.002 |
| 25092 | 0.004 |
| 25093 | 0.003 |
| 25094 | 0.001 |
| 25095 | 0.001 |
| 25096 | 0.002 |
| 25097 | 0.003 |
| 25098 | 0.001 |
| 25099 | 0.002 |
| 25100 | 0.004 |
| 25101 | 0.007 |
| 25102 | 0.003 |
| 25103 | 0.001 |
| 25104 | 0.006 |
| 25105 | 0.003 |
| 25106 | 0.005 |
| 25107 | 0.003 |
| 25108 | 0.005 |
| 25109 | 0.01 |
| 25110 | 0.001 |
| 25111 | 0.004 |
| 25112 | 0.005 |
| 25113 | 0.003 |
| 25114 | 0.003 |
| 25115 | 0.003 |
| 25116 | 0.005 |
| 25117 | 0.005 |
| 25118 | 0.003 |
| 25119 | 0.002 |
| 25120 | 0.005 |
| 25121 | 0.004 |
| 25122 | 0.004 |
| 25123 | 0.003 |
| 25124 | 0.004 |
| 25125 | 0.005 |
| 25126 | 0.002 |
| 25127 | 0.003 |
| 25128 | 0.005 |
| 25129 | 0.004 |
| 25130 | 0.003 |
| 25131 | 0.004 |
| 25132 | 0.005 |
| 25133 | 0.003 |
| 25134 | 0.001 |
| 25135 | 0.003 |
| 25136 | 0.001 |
| 25137 | 0.003 |
| 25138 | 0.003 |
| 25139 | 0.001 |
| 25140 | 0.003 |
| 25141 | 0.002 |
| 25142 | 0.004 |
| 25143 | 0.002 |
| 25144 | 0.004 |
| 25145 | 0.005 |
| 25146 | 0.002 |
| 25147 | 0.002 |
| 25148 | 0.001 |
| 25149 | 0.003 |
| 25150 | 0.002 |
| 25151 | 0.004 |
| 25152 | 0.002 |
| 25153 | 0.005 |
| 25154 | 0.003 |
| 25155 | 0.001 |
| 25156 | 0.004 |
| 25157 | 0.002 |
| 25158 | 0.004 |
| 25159 | 0.008 |
| 25160 | 0.007 |
| 25161 | 0.002 |
| 25162 | 0.003 |
| 25163 | 0.003 |
| 25164 | 0.003 |
| 25165 | 0.002 |
| 25166 | 0.003 |
| 25167 | 0.007 |
| 25168 | 0.003 |
| 25169 | 0.004 |
| 25170 | 0.007 |
| 25171 | 0.009 |
| 25172 | 0.003 |
| 25173 | 0.002 |
| 25174 | 0.005 |
| 25175 | 0.004 |
| 25176 | 0.004 |
| 25177 | 0.004 |
| 25178 | 0.003 |
| 25179 | 0.005 |
| 25180 | 0.005 |
| 25181 | 0.003 |
| 25182 | 0 |
| 25183 | 0.004 |
| 25184 | 0.005 |
| 25185 | 0.005 |
| 25186 | 0.005 |
| 25187 | 0.002 |
| 25188 | 0.003 |
| 25189 | 0.005 |
| 25190 | 0.001 |
| 25191 | 0.001 |
| 25192 | 0.003 |
| 25193 | 0.005 |
| 25194 | 0.003 |
| 25195 | 0.004 |
| 25196 | 0.006 |
| 25197 | 0.005 |
| 25198 | 0.003 |
| 25199 | 0.005 |
| 25200 | 0.004 |
| 25201 | 0.004 |
| 25202 | 0.002 |
| 25203 | 0.002 |
| 25204 | 0.002 |
| 25205 | 0.002 |
| 25206 | 0.005 |
| 25207 | 0.006 |
| 25208 | 0.005 |
| 25209 | 0.005 |
| 25210 | 0.003 |
| 25211 | 0.004 |
| 25212 | 0.006 |
| 25213 | 0.002 |
| 25214 | 0.002 |
| 25215 | 0.002 |
| 25216 | 0.005 |
| 25217 | 0.005 |
| 25218 | 0.005 |
| 25219 | 0.004 |
| 25220 | 0.008 |
| 25221 | 0.008 |
| 25222 | 0.003 |
| 25223 | 0.002 |
| 25224 | 0.01 |
| 25225 | 0.009 |
| 25226 | 0.004 |
| 25227 | 0.006 |
| 25228 | 0.006 |
| 25229 | 0.01 |
| 25230 | 0.002 |
| 25231 | 0.004 |
| 25232 | 0.003 |
| 25233 | 0.004 |
| 25234 | 0.001 |
| 25235 | 0.003 |
| 25236 | 0.002 |
| 25237 | 0.007 |
| 25238 | 0.002 |
| 25239 | 0.003 |
| 25240 | 0.002 |
| 25241 | 0.001 |
| 25242 | 0.005 |
| 25243 | 0.002 |
| 25244 | 0.005 |
| 25245 | 0.001 |
| 25246 | 0.008 |
| 25247 | 0.007 |
| 25248 | 0.011 |
| 25249 | 0.004 |
| 25250 | 0.005 |
| 25251 | 0.004 |
| 25252 | 0.004 |
| 25253 | 0.002 |
| 25254 | 0.002 |
| 25255 | 0.007 |
| 25256 | 0.006 |
| 25257 | 0.003 |
| 25258 | 0.001 |
| 25259 | 0.007 |
| 25260 | 0.004 |
| 25261 | 0.002 |
| 25262 | 0.002 |
| 25263 | 0.005 |
| 25264 | 0.007 |
| 25265 | 0.003 |
| 25266 | 0.004 |
| 25267 | 0.003 |
| 25268 | 0.003 |
| 25269 | 0.002 |
| 25270 | 0.006 |
| 25271 | 0.007 |
| 25272 | 0.006 |
| 25273 | 0.002 |
| 25274 | 0.001 |
| 25275 | 0.004 |
| 25276 | 0.006 |
| 25277 | 0.006 |
| 25278 | 0.003 |
| 25279 | 0.002 |
| 25280 | 0.006 |
| 25281 | 0.002 |
| 25282 | 0.006 |
| 25283 | 0.002 |
| 25284 | 0.004 |
| 25285 | 0.006 |
| 25286 | 0 |
| 25287 | 0.006 |
| 25288 | 0.008 |
| 25289 | 0.002 |
| 25290 | 0.005 |
| 25291 | 0.004 |
| 25292 | 0.006 |
| 25293 | 0.002 |
| 25294 | 0.002 |
| 25295 | 0.003 |
| 25296 | 0.002 |
| 25297 | 0.007 |
| 25298 | 0.007 |
| 25299 | 0.004 |
| 25300 | 0.004 |
| 25301 | 0.001 |
| 25302 | 0.005 |
| 25303 | 0.002 |
| 25304 | 0.004 |
| 25305 | 0.007 |
| 25306 | 0.009 |
| 25307 | 0.01 |
| 25308 | 0.004 |
| 25309 | 0.005 |
| 25310 | 0.005 |
| 25311 | 0.006 |
| 25312 | 0.001 |
| 25313 | 0.003 |
| 25314 | 0.002 |
| 25315 | 0.007 |
| 25316 | 0.012 |
| 25317 | 0.003 |
| 25318 | 0.006 |
| 25319 | 0.003 |
| 25320 | 0.005 |
| 25321 | 0.005 |
| 25322 | 0.003 |
| 25323 | 0.003 |
| 25324 | 0.003 |
| 25325 | 0.003 |
| 25326 | 0.003 |
| 25327 | 0.004 |
| 25328 | 0.008 |
| 25329 | 0.002 |
| 25330 | 0.004 |
| 25331 | 0.002 |
| 25332 | 0.001 |
| 25333 | 0.002 |
| 25334 | 0.002 |
| 25335 | 0.012 |
| 25336 | 0.003 |
| 25337 | 0.003 |
| 25338 | 0.001 |
| 25339 | 0.005 |
| 25340 | 0.005 |
| 25341 | 0.006 |
| 25342 | 0.005 |
| 25343 | 0.005 |
| 25344 | 0.002 |
| 25345 | 0.007 |
| 25346 | 0.003 |
| 25347 | 0.003 |
| 25348 | 0.002 |
| 25349 | 0.005 |
| 25350 | 0.003 |
| 25351 | 0.006 |
| 25352 | 0.005 |
| 25353 | 0.006 |
| 25354 | 0.004 |
| 25355 | 0.006 |
| 25356 | 0.003 |
| 25357 | 0.005 |
| 25358 | 0.004 |
| 25359 | 0.006 |
| 25360 | 0.007 |
| 25361 | 0.007 |
| 25362 | 0.006 |
| 25363 | 0.004 |
| 25364 | 0.007 |
| 25365 | 0.003 |
| 25366 | 0.006 |
| 25367 | 0.006 |
| 25368 | 0.003 |
| 25369 | 0.005 |
| 25370 | 0.003 |
| 25371 | 0.004 |
| 25372 | 0.005 |
| 25373 | 0.006 |
| 25374 | 0.015 |
| 25375 | 0.012 |
| 25376 | 0.006 |
| 25377 | 0.002 |
| 25378 | 0.004 |
| 25379 | 0.004 |
| 25380 | 0.002 |
| 25381 | 0.004 |
| 25382 | 0.003 |
| 25383 | 0.004 |
| 25384 | 0.005 |
| 25385 | 0.005 |
| 25386 | 0.002 |
| 25387 | 0.004 |
| 25388 | 0.002 |
| 25389 | 0.003 |
| 25390 | 0.003 |
| 25391 | 0.004 |
| 25392 | 0.007 |
| 25393 | 0.005 |
| 25394 | 0.005 |
| 25395 | 0.006 |
| 25396 | 0.006 |
| 25397 | 0.003 |
| 25398 | 0.002 |
| 25399 | 0.006 |
| 25400 | 0.006 |
| 25401 | 0.003 |
| 25402 | 0.003 |
| 25403 | 0.002 |
| 25404 | 0.006 |
| 25405 | 0.002 |
| 25406 | 0.002 |
| 25407 | 0.006 |
| 25408 | 0.005 |
| 25409 | 0.002 |
| 25410 | 0.004 |
| 25411 | 0.005 |
| 25412 | 0.005 |
| 25413 | 0.005 |
| 25414 | 0.006 |
| 25415 | 0.007 |
| 25416 | 0.005 |
| 25417 | 0.002 |
| 25418 | 0.004 |
| 25419 | 0.002 |
| 25420 | 0.006 |
| 25421 | 0.002 |
| 25422 | 0.002 |
| 25423 | 0.007 |
| 25424 | 0.003 |
| 25425 | 0.002 |
| 25426 | 0.003 |
| 25427 | 0.003 |
| 25428 | 0.007 |
| 25429 | 0.002 |
| 25430 | 0.003 |
| 25431 | 0.007 |
| 25432 | 0.008 |
| 25433 | 0.003 |
| 25434 | 0.003 |
| 25435 | 0.004 |
| 25436 | 0.008 |
| 25437 | 0.005 |
| 25438 | 0.003 |
| 25439 | 0.003 |
| 25440 | 0.006 |
| 25441 | 0.001 |
| 25442 | 0.005 |
| 25443 | 0.003 |
| 25444 | 0.002 |
| 25445 | 0.002 |
| 25446 | 0.003 |
| 25447 | 0.008 |
| 25448 | 0.009 |
| 25449 | 0.003 |
| 25450 | 0.002 |
| 25451 | 0.006 |
| 25452 | 0.002 |
| 25453 | 0.002 |
| 25454 | 0.001 |
| 25455 | 0.007 |
| 25456 | 0.003 |
| 25457 | 0.001 |
| 25458 | 0.003 |
| 25459 | 0.004 |
| 25460 | 0.004 |
| 25461 | 0.002 |
| 25462 | 0.004 |
| 25463 | 0.003 |
| 25464 | 0.003 |
| 25465 | 0.002 |
| 25466 | 0.005 |
| 25467 | 0.006 |
| 25468 | 0.001 |
| 25469 | 0.001 |
| 25470 | 0.004 |
| 25471 | 0.003 |
| 25472 | 0.005 |
| 25473 | 0.002 |
| 25474 | 0.004 |
| 25475 | 0.002 |
| 25476 | 0.003 |
| 25477 | 0.009 |
| 25478 | 0.002 |
| 25479 | 0.001 |
| 25480 | 0.005 |
| 25481 | 0.002 |
| 25482 | 0.005 |
| 25483 | 0.002 |
| 25484 | 0.002 |
| 25485 | 0.007 |
| 25486 | 0.001 |
| 25487 | 0.002 |
| 25488 | 0.006 |
| 25489 | 0.002 |
| 25490 | 0.002 |
| 25491 | 0.002 |
| 25492 | 0.007 |
| 25493 | 0.005 |
| 25494 | 0.001 |
| 25495 | 0.003 |
| 25496 | 0.003 |
| 25497 | 0.007 |
| 25498 | 0.004 |
| 25499 | 0.003 |
| 25500 | 0.013 |
| 25501 | 0.014 |
| 25502 | 0.003 |
| 25503 | 0.003 |
| 25504 | 0.004 |
| 25505 | 0.003 |
| 25506 | 0.003 |
| 25507 | 0.003 |
| 25508 | 0.005 |
| 25509 | 0.004 |
| 25510 | 0.002 |
| 25511 | 0.001 |
| 25512 | 0.003 |
| 25513 | 0.003 |
| 25514 | 0.002 |
| 25515 | 0.002 |
| 25516 | 0.007 |
| 25517 | 0.006 |
| 25518 | 0.001 |
| 25519 | 0.002 |
| 25520 | 0.006 |
| 25521 | 0.002 |
| 25522 | 0.003 |
| 25523 | 0.004 |
| 25524 | 0.002 |
| 25525 | 0.004 |
| 25526 | 0.001 |
| 25527 | 0.003 |
| 25528 | 0.009 |
| 25529 | 0.006 |
| 25530 | 0.004 |
| 25531 | 0.004 |
| 25532 | 0.005 |
| 25533 | 0.001 |
| 25534 | 0.004 |
| 25535 | 0.008 |
| 25536 | 0.003 |
| 25537 | 0.003 |
| 25538 | 0.004 |
| 25539 | 0.006 |
| 25540 | 0.006 |
| 25541 | 0.003 |
| 25542 | 0.008 |
| 25543 | 0.005 |
| 25544 | 0.007 |
| 25545 | 0.005 |
| 25546 | 0.003 |
| 25547 | 0.008 |
| 25548 | 0.009 |
| 25549 | 0.002 |
| 25550 | 0.002 |
| 25551 | 0.002 |
| 25552 | 0.008 |
| 25553 | 0.001 |
| 25554 | 0.003 |
| 25555 | 0.003 |
| 25556 | 0.001 |
| 25557 | 0.003 |
| 25558 | 0.008 |
| 25559 | 0.007 |
| 25560 | 0.003 |
| 25561 | 0.004 |
| 25562 | 0.004 |
| 25563 | 0.003 |
| 25564 | 0.003 |
| 25565 | 0.003 |
| 25566 | 0.003 |
| 25567 | 0.008 |
| 25568 | 0.002 |
| 25569 | 0.002 |
| 25570 | 0.003 |
| 25571 | 0.007 |
| 25572 | 0.012 |
| 25573 | 0.005 |
| 25574 | 0.003 |
| 25575 | 0.007 |
| 25576 | 0.004 |
| 25577 | 0.003 |
| 25578 | 0.002 |
| 25579 | 0.003 |
| 25580 | 0.004 |
| 25581 | 0.002 |
| 25582 | 0.003 |
| 25583 | 0.002 |
| 25584 | 0.006 |
| 25585 | 0.004 |
| 25586 | 0.004 |
| 25587 | 0.004 |
| 25588 | 0.003 |
| 25589 | 0.004 |
| 25590 | 0.002 |
| 25591 | 0.003 |
| 25592 | 0.002 |
| 25593 | 0.003 |
| 25594 | 0.002 |
| 25595 | 0.002 |
| 25596 | 0.005 |
| 25597 | 0.003 |
| 25598 | 0.003 |
| 25599 | 0.003 |
| 25600 | 0.004 |
| 25601 | 0.004 |
| 25602 | 0.003 |
| 25603 | 0.003 |
| 25604 | 0.006 |
| 25605 | 0.003 |
| 25606 | 0.005 |
| 25607 | 0.008 |
| 25608 | 0.01 |
| 25609 | 0.001 |
| 25610 | 0.002 |
| 25611 | 0.002 |
| 25612 | 0.002 |
| 25613 | 0.001 |
| 25614 | 0.003 |
| 25615 | 0.001 |
| 25616 | 0.003 |
| 25617 | 0.002 |
| 25618 | 0.003 |
| 25619 | 0.003 |
| 25620 | 0.005 |
| 25621 | 0.008 |
| 25622 | 0.008 |
| 25623 | 0.006 |
| 25624 | 0.003 |
| 25625 | 0.002 |
| 25626 | 0.007 |
| 25627 | 0.006 |
| 25628 | 0.005 |
| 25629 | 0.006 |
| 25630 | 0.004 |
| 25631 | 0.002 |
| 25632 | 0.002 |
| 25633 | 0.007 |
| 25634 | 0.012 |
| 25635 | 0.001 |
| 25636 | 0.004 |
| 25637 | 0.002 |
| 25638 | 0.002 |
| 25639 | 0.002 |
| 25640 | 0.003 |
| 25641 | 0.003 |
| 25642 | 0.002 |
| 25643 | 0.006 |
| 25644 | 0.002 |
| 25645 | 0.003 |
| 25646 | 0.005 |
| 25647 | 0.007 |
| 25648 | 0.003 |
| 25649 | 0.003 |
| 25650 | 0.002 |
| 25651 | 0.002 |
| 25652 | 0.007 |
| 25653 | 0.009 |
| 25654 | 0.008 |
| 25655 | 0.006 |
| 25656 | 0.002 |
| 25657 | 0.005 |
| 25658 | 0.008 |
| 25659 | 0.006 |
| 25660 | 0.007 |
| 25661 | 0.006 |
| 25662 | 0.006 |
| 25663 | 0.008 |
| 25664 | 0.01 |
| 25665 | 0.007 |
| 25666 | 0.007 |
| 25667 | 0.005 |
| 25668 | 0.004 |
| 25669 | 0.007 |
| 25670 | 0.001 |
| 25671 | 0.001 |
| 25672 | 0.002 |
| 25673 | 0.004 |
| 25674 | 0.005 |
| 25675 | 0.007 |
| 25676 | 0.004 |
| 25677 | 0.003 |
| 25678 | 0.002 |
| 25679 | 0.006 |
| 25680 | 0.004 |
| 25681 | 0.004 |
| 25682 | 0.002 |
| 25683 | 0.004 |
| 25684 | 0.006 |
| 25685 | 0.002 |
| 25686 | 0.001 |
| 25687 | 0.004 |
| 25688 | 0.006 |
| 25689 | 0.01 |
| 25690 | 0.003 |
| 25691 | 0.002 |
| 25692 | 0.003 |
| 25693 | 0.007 |
| 25694 | 0.002 |
| 25695 | 0.004 |
| 25696 | 0.004 |
| 25697 | 0.005 |
| 25698 | 0.002 |
| 25699 | 0.005 |
| 25700 | 0.004 |
| 25701 | 0.005 |
| 25702 | 0.01 |
| 25703 | 0.011 |
| 25704 | 0.002 |
| 25705 | 0.006 |
| 25706 | 0.003 |
| 25707 | 0.003 |
| 25708 | 0.005 |
| 25709 | 0.006 |
| 25710 | 0.003 |
| 25711 | 0.001 |
| 25712 | 0.002 |
| 25713 | 0.003 |
| 25714 | 0.002 |
| 25715 | 0.004 |
| 25716 | 0.005 |
| 25717 | 0.004 |
| 25718 | 0.002 |
| 25719 | 0.001 |
| 25720 | 0.003 |
| 25721 | 0.003 |
| 25722 | 0.001 |
| 25723 | 0.003 |
| 25724 | 0.004 |
| 25725 | 0.003 |
| 25726 | 0.01 |
| 25727 | 0.006 |
| 25728 | 0.007 |
| 25729 | 0.002 |
| 25730 | 0.004 |
| 25731 | 0.004 |
| 25732 | 0.004 |
| 25733 | 0.004 |
| 25734 | 0.003 |
| 25735 | 0.002 |
| 25736 | 0.002 |
| 25737 | 0.003 |
| 25738 | 0.003 |
| 25739 | 0.002 |
| 25740 | 0.005 |
| 25741 | 0.004 |
| 25742 | 0.002 |
| 25743 | 0.003 |
| 25744 | 0.004 |
| 25745 | 0.002 |
| 25746 | 0.002 |
| 25747 | 0.003 |
| 25748 | 0.003 |
| 25749 | 0.007 |
| 25750 | 0.005 |
| 25751 | 0.004 |
| 25752 | 0.004 |
| 25753 | 0.005 |
| 25754 | 0.004 |
| 25755 | 0.005 |
| 25756 | 0.009 |
| 25757 | 0.005 |
| 25758 | 0.004 |
| 25759 | 0.003 |
| 25760 | 0.006 |
| 25761 | 0.005 |
| 25762 | 0.002 |
| 25763 | 0.005 |
| 25764 | 0.01 |
| 25765 | 0.005 |
| 25766 | 0.001 |
| 25767 | 0.002 |
| 25768 | 0.004 |
| 25769 | 0.005 |
| 25770 | 0.003 |
| 25771 | 0.004 |
| 25772 | 0.005 |
| 25773 | 0.005 |
| 25774 | 0.002 |
| 25775 | 0.004 |
| 25776 | 0.007 |
| 25777 | 0.002 |
| 25778 | 0.002 |
| 25779 | 0.009 |
| 25780 | 0.007 |
| 25781 | 0.009 |
| 25782 | 0.002 |
| 25783 | 0.003 |
| 25784 | 0.004 |
| 25785 | 0.004 |
| 25786 | 0.004 |
| 25787 | 0.008 |
| 25788 | 0.009 |
| 25789 | 0.004 |
| 25790 | 0.003 |
| 25791 | 0.006 |
| 25792 | 0.003 |
| 25793 | 0.005 |
| 25794 | 0.001 |
| 25795 | 0.004 |
| 25796 | 0.002 |
| 25797 | 0.005 |
| 25798 | 0.003 |
| 25799 | 0.005 |
| 25800 | 0.004 |
| 25801 | 0.004 |
| 25802 | 0.003 |
| 25803 | 0.008 |
| 25804 | 0.009 |
| 25805 | 0.006 |
| 25806 | 0.002 |
| 25807 | 0.002 |
| 25808 | 0.008 |
| 25809 | 0.008 |
| 25810 | 0.002 |
| 25811 | 0.001 |
| 25812 | 0.004 |
| 25813 | 0.004 |
| 25814 | 0.007 |
| 25815 | 0.004 |
| 25816 | 0.006 |
| 25817 | 0.004 |
| 25818 | 0.003 |
| 25819 | 0.007 |
| 25820 | 0.005 |
| 25821 | 0.003 |
| 25822 | 0.002 |
| 25823 | 0.004 |
| 25824 | 0.006 |
| 25825 | 0.003 |
| 25826 | 0.003 |
| 25827 | 0.005 |
| 25828 | 0.003 |
| 25829 | 0.001 |
| 25830 | 0.005 |
| 25831 | 0.002 |
| 25832 | 0.003 |
| 25833 | 0.005 |
| 25834 | 0.004 |
| 25835 | 0.003 |
| 25836 | 0.007 |
| 25837 | 0.004 |
| 25838 | 0.003 |
| 25839 | 0.003 |
| 25840 | 0.002 |
| 25841 | 0.005 |
| 25842 | 0.003 |
| 25843 | 0.003 |
| 25844 | 0.004 |
| 25845 | 0.002 |
| 25846 | 0.003 |
| 25847 | 0.007 |
| 25848 | 0.007 |
| 25849 | 0.001 |
| 25850 | 0.001 |
| 25851 | 0.008 |
| 25852 | 0.008 |
| 25853 | 0.003 |
| 25854 | 0.003 |
| 25855 | 0.005 |
| 25856 | 0.012 |
| 25857 | 0.002 |
| 25858 | 0.004 |
| 25859 | 0.006 |
| 25860 | 0.005 |
| 25861 | 0.001 |
| 25862 | 0.001 |
| 25863 | 0.007 |
| 25864 | 0.004 |
| 25865 | 0.002 |
| 25866 | 0.002 |
| 25867 | 0.003 |
| 25868 | 0.003 |
| 25869 | 0.004 |
| 25870 | 0.006 |
| 25871 | 0.003 |
| 25872 | 0.006 |
| 25873 | 0.001 |
| 25874 | 0.002 |
| 25875 | 0.002 |
| 25876 | 0.003 |
| 25877 | 0.003 |
| 25878 | 0.004 |
| 25879 | 0.008 |
| 25880 | 0.006 |
| 25881 | 0.004 |
| 25882 | 0.004 |
| 25883 | 0.002 |
| 25884 | 0.002 |
| 25885 | 0.002 |
| 25886 | 0.003 |
| 25887 | 0.007 |
| 25888 | 0.007 |
| 25889 | 0.002 |
| 25890 | 0.004 |
| 25891 | 0.01 |
| 25892 | 0.008 |
| 25893 | 0.004 |
| 25894 | 0.003 |
| 25895 | 0.006 |
| 25896 | 0.007 |
| 25897 | 0.007 |
| 25898 | 0.003 |
| 25899 | 0.004 |
| 25900 | 0.007 |
| 25901 | 0.002 |
| 25902 | 0.003 |
| 25903 | 0.004 |
| 25904 | 0.003 |
| 25905 | 0.001 |
| 25906 | 0.003 |
| 25907 | 0.003 |
| 25908 | 0.004 |
| 25909 | 0.001 |
| 25910 | 0.002 |
| 25911 | 0.002 |
| 25912 | 0.004 |
| 25913 | 0.003 |
| 25914 | 0.002 |
| 25915 | 0.003 |
| 25916 | 0.006 |
| 25917 | 0.003 |
| 25918 | 0.003 |
| 25919 | 0.005 |
| 25920 | 0.003 |
| 25921 | 0.005 |
| 25922 | 0.005 |
| 25923 | 0.004 |
| 25924 | 0.002 |
| 25925 | 0.005 |
| 25926 | 0.005 |
| 25927 | 0.007 |
| 25928 | 0.006 |
| 25929 | 0.002 |
| 25930 | 0.006 |
| 25931 | 0.006 |
| 25932 | 0.003 |
| 25933 | 0.008 |
| 25934 | 0.004 |
| 25935 | 0.004 |
| 25936 | 0.004 |
| 25937 | 0.006 |
| 25938 | 0.003 |
| 25939 | 0.003 |
| 25940 | 0.009 |
| 25941 | 0.002 |
| 25942 | 0.003 |
| 25943 | 0.001 |
| 25944 | 0.005 |
| 25945 | 0.002 |
| 25946 | 0.004 |
| 25947 | 0.004 |
| 25948 | 0.007 |
| 25949 | 0.005 |
| 25950 | 0.007 |
| 25951 | 0.003 |
| 25952 | 0.003 |
| 25953 | 0.005 |
| 25954 | 0.003 |
| 25955 | 0.006 |
| 25956 | 0.004 |
| 25957 | 0.007 |
| 25958 | 0.006 |
| 25959 | 0.007 |
| 25960 | 0.009 |
| 25961 | 0.013 |
| 25962 | 0.005 |
| 25963 | 0.006 |
| 25964 | 0.004 |
| 25965 | 0.006 |
| 25966 | 0.007 |
| 25967 | 0.016 |
| 25968 | 0.019 |
| 25969 | 0.01 |
| 25970 | 0.002 |
| 25971 | 0.007 |
| 25972 | 0.003 |
| 25973 | 0.005 |
| 25974 | 0.007 |
| 25975 | 0.002 |
| 25976 | 0.002 |
| 25977 | 0.003 |
| 25978 | 0.003 |
| 25979 | 0.005 |
| 25980 | 0.009 |
| 25981 | 0.001 |
| 25982 | 0.004 |
| 25983 | 0.002 |
| 25984 | 0.004 |
| 25985 | 0.004 |
| 25986 | 0.005 |
| 25987 | 0.005 |
| 25988 | 0.003 |
| 25989 | 0.002 |
| 25990 | 0.003 |
| 25991 | 0.004 |
| 25992 | 0.006 |
| 25993 | 0.003 |
| 25994 | 0.003 |
| 25995 | 0.003 |
| 25996 | 0.006 |
| 25997 | 0.007 |
| 25998 | 0.004 |
| 25999 | 0.005 |
| 26000 | 0.007 |
| 26001 | 0.006 |
| 26002 | 0.001 |
| 26003 | 0.001 |
| 26004 | 0.005 |
| 26005 | 0.005 |
| 26006 | 0.003 |
| 26007 | 0.004 |
| 26008 | 0.005 |
| 26009 | 0.006 |
| 26010 | 0.004 |
| 26011 | 0.004 |
| 26012 | 0.006 |
| 26013 | 0.003 |
| 26014 | 0.004 |
| 26015 | 0.003 |
| 26016 | 0.004 |
| 26017 | 0.003 |
| 26018 | 0.001 |
| 26019 | 0.005 |
| 26020 | 0.002 |
| 26021 | 0.002 |
| 26022 | 0.002 |
| 26023 | 0.003 |
| 26024 | 0.005 |
| 26025 | 0.001 |
| 26026 | 0.002 |
| 26027 | 0.007 |
| 26028 | 0.002 |
| 26029 | 0.006 |
| 26030 | 0.003 |
| 26031 | 0.004 |
| 26032 | 0.007 |
| 26033 | 0.001 |
| 26034 | 0.003 |
| 26035 | 0.002 |
| 26036 | 0.004 |
| 26037 | 0.005 |
| 26038 | 0.001 |
| 26039 | 0.008 |
| 26040 | 0.008 |
| 26041 | 0.003 |
| 26042 | 0.004 |
| 26043 | 0.006 |
| 26044 | 0.004 |
| 26045 | 0.002 |
| 26046 | 0.002 |
| 26047 | 0.004 |
| 26048 | 0.004 |
| 26049 | 0.008 |
| 26050 | 0.004 |
| 26051 | 0.005 |
| 26052 | 0.005 |
| 26053 | 0.004 |
| 26054 | 0.001 |
| 26055 | 0.004 |
| 26056 | 0.004 |
| 26057 | 0.006 |
| 26058 | 0.004 |
| 26059 | 0.003 |
| 26060 | 0.004 |
| 26061 | 0.004 |
| 26062 | 0.002 |
| 26063 | 0.001 |
| 26064 | 0.004 |
| 26065 | 0.004 |
| 26066 | 0.001 |
| 26067 | 0.003 |
| 26068 | 0.006 |
| 26069 | 0.01 |
| 26070 | 0.002 |
| 26071 | 0.004 |
| 26072 | 0.005 |
| 26073 | 0.002 |
| 26074 | 0.004 |
| 26075 | 0.002 |
| 26076 | 0.003 |
| 26077 | 0.002 |
| 26078 | 0.001 |
| 26079 | 0.004 |
| 26080 | 0.003 |
| 26081 | 0.005 |
| 26082 | 0.001 |
| 26083 | 0.001 |
| 26084 | 0.002 |
| 26085 | 0.005 |
| 26086 | 0.003 |
| 26087 | 0.002 |
| 26088 | 0.005 |
| 26089 | 0.004 |
| 26090 | 0.001 |
| 26091 | 0.002 |
| 26092 | 0.003 |
| 26093 | 0.005 |
| 26094 | 0.002 |
| 26095 | 0.004 |
| 26096 | 0.004 |
| 26097 | 0.003 |
| 26098 | 0.002 |
| 26099 | 0.004 |
| 26100 | 0.003 |
| 26101 | 0.003 |
| 26102 | 0.01 |
| 26103 | 0.008 |
| 26104 | 0.005 |
| 26105 | 0.004 |
| 26106 | 0.006 |
| 26107 | 0.007 |
| 26108 | 0.007 |
| 26109 | 0.008 |
| 26110 | 0.004 |
| 26111 | 0.006 |
| 26112 | 0.007 |
| 26113 | 0.005 |
| 26114 | 0.004 |
| 26115 | 0.003 |
| 26116 | 0.006 |
| 26117 | 0.002 |
| 26118 | 0.002 |
| 26119 | 0.005 |
| 26120 | 0.002 |
| 26121 | 0.003 |
| 26122 | 0.005 |
| 26123 | 0.008 |
| 26124 | 0.008 |
| 26125 | 0.001 |
| 26126 | 0.003 |
| 26127 | 0.003 |
| 26128 | 0.002 |
| 26129 | 0.008 |
| 26130 | 0.006 |
| 26131 | 0.005 |
| 26132 | 0.006 |
| 26133 | 0.002 |
| 26134 | 0.002 |
| 26135 | 0.002 |
| 26136 | 0.004 |
| 26137 | 0.004 |
| 26138 | 0.003 |
| 26139 | 0.007 |
| 26140 | 0.006 |
| 26141 | 0.003 |
| 26142 | 0.002 |
| 26143 | 0.004 |
| 26144 | 0.005 |
| 26145 | 0.003 |
| 26146 | 0.004 |
| 26147 | 0.005 |
| 26148 | 0.002 |
| 26149 | 0.004 |
| 26150 | 0.002 |
| 26151 | 0.007 |
| 26152 | 0.009 |
| 26153 | 0.004 |
| 26154 | 0.002 |
| 26155 | 0.007 |
| 26156 | 0.005 |
| 26157 | 0.002 |
| 26158 | 0.009 |
| 26159 | 0.007 |
| 26160 | 0.003 |
| 26161 | 0.002 |
| 26162 | 0.002 |
| 26163 | 0.006 |
| 26164 | 0.009 |
| 26165 | 0.001 |
| 26166 | 0.005 |
| 26167 | 0.007 |
| 26168 | 0.006 |
| 26169 | 0.004 |
| 26170 | 0.004 |
| 26171 | 0.003 |
| 26172 | 0.003 |
| 26173 | 0.001 |
| 26174 | 0.002 |
| 26175 | 0.009 |
| 26176 | 0.009 |
| 26177 | 0.004 |
| 26178 | 0.004 |
| 26179 | 0.006 |
| 26180 | 0.003 |
| 26181 | 0.002 |
| 26182 | 0.001 |
| 26183 | 0.006 |
| 26184 | 0.008 |
| 26185 | 0.006 |
| 26186 | 0.003 |
| 26187 | 0.006 |
| 26188 | 0.011 |
| 26189 | 0.005 |
| 26190 | 0.005 |
| 26191 | 0.008 |
| 26192 | 0.005 |
| 26193 | 0.005 |
| 26194 | 0.002 |
| 26195 | 0.005 |
| 26196 | 0.005 |
| 26197 | 0.004 |
| 26198 | 0 |
| 26199 | 0.005 |
| 26200 | 0.012 |
| 26201 | 0.005 |
| 26202 | 0.004 |
| 26203 | 0.004 |
| 26204 | 0.006 |
| 26205 | 0.004 |
| 26206 | 0.003 |
| 26207 | 0.004 |
| 26208 | 0.009 |
| 26209 | 0.003 |
| 26210 | 0.002 |
| 26211 | 0.004 |
| 26212 | 0.003 |
| 26213 | 0.004 |
| 26214 | 0.001 |
| 26215 | 0.001 |
| 26216 | 0.005 |
| 26217 | 0.01 |
| 26218 | 0.003 |
| 26219 | 0.005 |
| 26220 | 0.004 |
| 26221 | 0.005 |
| 26222 | 0.002 |
| 26223 | 0.002 |
| 26224 | 0.003 |
| 26225 | 0.005 |
| 26226 | 0.002 |
| 26227 | 0.001 |
| 26228 | 0.002 |
| 26229 | 0.004 |
| 26230 | 0.006 |
| 26231 | 0.003 |
| 26232 | 0.002 |
| 26233 | 0.001 |
| 26234 | 0.006 |
| 26235 | 0.001 |
| 26236 | 0.004 |
| 26237 | 0.004 |
| 26238 | 0.003 |
| 26239 | 0.002 |
| 26240 | 0.005 |
| 26241 | 0.002 |
| 26242 | 0.005 |
| 26243 | 0.003 |
| 26244 | 0.002 |
| 26245 | 0.009 |
| 26246 | 0.002 |
| 26247 | 0.002 |
| 26248 | 0.003 |
| 26249 | 0.004 |
| 26250 | 0.002 |
| 26251 | 0.003 |
| 26252 | 0.004 |
| 26253 | 0.003 |
| 26254 | 0.001 |
| 26255 | 0.002 |
| 26256 | 0.004 |
| 26257 | 0.005 |
| 26258 | 0.004 |
| 26259 | 0.002 |
| 26260 | 0.003 |
| 26261 | 0.001 |
| 26262 | 0.004 |
| 26263 | 0.001 |
| 26264 | 0.008 |
| 26265 | 0.002 |
| 26266 | 0.007 |
| 26267 | 0.007 |
| 26268 | 0.002 |
| 26269 | 0.004 |
| 26270 | 0.01 |
| 26271 | 0.003 |
| 26272 | 0.002 |
| 26273 | 0.007 |
| 26274 | 0.002 |
| 26275 | 0.003 |
| 26276 | 0.006 |
| 26277 | 0.005 |
| 26278 | 0.01 |
| 26279 | 0.005 |
| 26280 | 0.007 |
| 26281 | 0.008 |
| 26282 | 0.003 |
| 26283 | 0.005 |
| 26284 | 0.005 |
| 26285 | 0.004 |
| 26286 | 0.004 |
| 26287 | 0.01 |
| 26288 | 0.002 |
| 26289 | 0.002 |
| 26290 | 0 |
| 26291 | 0.002 |
| 26292 | 0.001 |
| 26293 | 0.006 |
| 26294 | 0.005 |
| 26295 | 0.006 |
| 26296 | 0.004 |
| 26297 | 0.003 |
| 26298 | 0.003 |
| 26299 | 0.007 |
| 26300 | 0.002 |
| 26301 | 0.004 |
| 26302 | 0 |
| 26303 | 0.003 |
| 26304 | 0.006 |
| 26305 | 0.001 |
| 26306 | 0.002 |
| 26307 | 0.006 |
| 26308 | 0.005 |
| 26309 | 0.002 |
| 26310 | 0.006 |
| 26311 | 0.005 |
| 26312 | 0.006 |
| 26313 | 0.003 |
| 26314 | 0.001 |
| 26315 | 0.002 |
| 26316 | 0.006 |
| 26317 | 0.001 |
| 26318 | 0.004 |
| 26319 | 0.004 |
| 26320 | 0.005 |
| 26321 | 0.003 |
| 26322 | 0.008 |
| 26323 | 0.007 |
| 26324 | 0.007 |
| 26325 | 0.001 |
| 26326 | 0.004 |
| 26327 | 0.002 |
| 26328 | 0.002 |
| 26329 | 0.002 |
| 26330 | 0.002 |
| 26331 | 0.007 |
| 26332 | 0.003 |
| 26333 | 0.01 |
| 26334 | 0.004 |
| 26335 | 0.003 |
| 26336 | 0.007 |
| 26337 | 0.002 |
| 26338 | 0.003 |
| 26339 | 0.004 |
| 26340 | 0.003 |
| 26341 | 0.002 |
| 26342 | 0.002 |
| 26343 | 0.001 |
| 26344 | 0.003 |
| 26345 | 0.003 |
| 26346 | 0.004 |
| 26347 | 0.003 |
| 26348 | 0.002 |
| 26349 | 0.006 |
| 26350 | 0.003 |
| 26351 | 0.003 |
| 26352 | 0.011 |
| 26353 | 0.006 |
| 26354 | 0.001 |
| 26355 | 0.001 |
| 26356 | 0 |
| 26357 | 0.002 |
| 26358 | 0.006 |
| 26359 | 0.007 |
| 26360 | 0.002 |
| 26361 | 0.004 |
| 26362 | 0.003 |
| 26363 | 0.005 |
| 26364 | 0.003 |
| 26365 | 0.001 |
| 26366 | 0.004 |
| 26367 | 0.003 |
| 26368 | 0.005 |
| 26369 | 0.002 |
| 26370 | 0.004 |
| 26371 | 0.009 |
| 26372 | 0.005 |
| 26373 | 0.001 |
| 26374 | 0.003 |
| 26375 | 0.005 |
| 26376 | 0.003 |
| 26377 | 0.003 |
| 26378 | 0.003 |
| 26379 | 0.005 |
| 26380 | 0.004 |
| 26381 | 0.002 |
| 26382 | 0.001 |
| 26383 | 0.004 |
| 26384 | 0.007 |
| 26385 | 0.004 |
| 26386 | 0.006 |
| 26387 | 0.006 |
| 26388 | 0.003 |
| 26389 | 0.004 |
| 26390 | 0.002 |
| 26391 | 0.007 |
| 26392 | 0.008 |
| 26393 | 0.007 |
| 26394 | 0.002 |
| 26395 | 0.002 |
| 26396 | 0.006 |
| 26397 | 0.004 |
| 26398 | 0.002 |
| 26399 | 0.002 |
| 26400 | 0.006 |
| 26401 | 0.008 |
| 26402 | 0.002 |
| 26403 | 0.003 |
| 26404 | 0.005 |
| 26405 | 0.005 |
| 26406 | 0.008 |
| 26407 | 0.001 |
| 26408 | 0.001 |
| 26409 | 0.003 |
| 26410 | 0.002 |
| 26411 | 0.008 |
| 26412 | 0.002 |
| 26413 | 0.004 |
| 26414 | 0.006 |
| 26415 | 0.005 |
| 26416 | 0.002 |
| 26417 | 0.002 |
| 26418 | 0.003 |
| 26419 | 0.003 |
| 26420 | 0.005 |
| 26421 | 0.004 |
| 26422 | 0.004 |
| 26423 | 0.005 |
| 26424 | 0.008 |
| 26425 | 0.003 |
| 26426 | 0.002 |
| 26427 | 0.001 |
| 26428 | 0.008 |
| 26429 | 0.002 |
| 26430 | 0.003 |
| 26431 | 0.008 |
| 26432 | 0.003 |
| 26433 | 0.003 |
| 26434 | 0.003 |
| 26435 | 0.005 |
| 26436 | 0.005 |
| 26437 | 0.004 |
| 26438 | 0.006 |
| 26439 | 0.005 |
| 26440 | 0.005 |
| 26441 | 0.003 |
| 26442 | 0.005 |
| 26443 | 0.004 |
| 26444 | 0.002 |
| 26445 | 0.003 |
| 26446 | 0.002 |
| 26447 | 0.005 |
| 26448 | 0.003 |
| 26449 | 0.001 |
| 26450 | 0.003 |
| 26451 | 0.007 |
| 26452 | 0.006 |
| 26453 | 0.002 |
| 26454 | 0.003 |
| 26455 | 0.002 |
| 26456 | 0.009 |
| 26457 | 0.001 |
| 26458 | 0.001 |
| 26459 | 0.003 |
| 26460 | 0.001 |
| 26461 | 0.003 |
| 26462 | 0.006 |
| 26463 | 0.005 |
| 26464 | 0.004 |
| 26465 | 0.002 |
| 26466 | 0.009 |
| 26467 | 0.009 |
| 26468 | 0.005 |
| 26469 | 0.001 |
| 26470 | 0.001 |
| 26471 | 0.004 |
| 26472 | 0.007 |
| 26473 | 0.006 |
| 26474 | 0.003 |
| 26475 | 0.003 |
| 26476 | 0.002 |
| 26477 | 0.006 |
| 26478 | 0.003 |
| 26479 | 0.004 |
| 26480 | 0.004 |
| 26481 | 0.004 |
| 26482 | 0.002 |
| 26483 | 0.005 |
| 26484 | 0.001 |
| 26485 | 0.005 |
| 26486 | 0.002 |
| 26487 | 0.003 |
| 26488 | 0.003 |
| 26489 | 0.003 |
| 26490 | 0.003 |
| 26491 | 0.003 |
| 26492 | 0.004 |
| 26493 | 0.009 |
| 26494 | 0.001 |
| 26495 | 0.003 |
| 26496 | 0.003 |
| 26497 | 0.003 |
| 26498 | 0.002 |
| 26499 | 0.005 |
| 26500 | 0.004 |
| 26501 | 0.004 |
| 26502 | 0.007 |
| 26503 | 0.003 |
| 26504 | 0.002 |
| 26505 | 0.004 |
| 26506 | 0.007 |
| 26507 | 0.006 |
| 26508 | 0.004 |
| 26509 | 0.004 |
| 26510 | 0.004 |
| 26511 | 0.003 |
| 26512 | 0.004 |
| 26513 | 0.004 |
| 26514 | 0.002 |
| 26515 | 0.003 |
| 26516 | 0.003 |
| 26517 | 0.002 |
| 26518 | 0.001 |
| 26519 | 0.003 |
| 26520 | 0.003 |
| 26521 | 0.004 |
| 26522 | 0.004 |
| 26523 | 0.004 |
| 26524 | 0.009 |
| 26525 | 0.008 |
| 26526 | 0.003 |
| 26527 | 0.003 |
| 26528 | 0.006 |
| 26529 | 0.003 |
| 26530 | 0.004 |
| 26531 | 0.003 |
| 26532 | 0.004 |
| 26533 | 0.009 |
| 26534 | 0.004 |
| 26535 | 0.003 |
| 26536 | 0.001 |
| 26537 | 0.004 |
| 26538 | 0.003 |
| 26539 | 0.001 |
| 26540 | 0.003 |
| 26541 | 0.003 |
| 26542 | 0.003 |
| 26543 | 0.001 |
| 26544 | 0.001 |
| 26545 | 0.007 |
| 26546 | 0.004 |
| 26547 | 0.002 |
| 26548 | 0.001 |
| 26549 | 0.006 |
| 26550 | 0.003 |
| 26551 | 0.009 |
| 26552 | 0.011 |
| 26553 | 0.007 |
| 26554 | 0.003 |
| 26555 | 0.006 |
| 26556 | 0.004 |
| 26557 | 0.007 |
| 26558 | 0.003 |
| 26559 | 0.003 |
| 26560 | 0.003 |
| 26561 | 0.004 |
| 26562 | 0.002 |
| 26563 | 0.003 |
| 26564 | 0.004 |
| 26565 | 0.005 |
| 26566 | 0.003 |
| 26567 | 0.002 |
| 26568 | 0.004 |
| 26569 | 0.003 |
| 26570 | 0.003 |
| 26571 | 0.005 |
| 26572 | 0.006 |
| 26573 | 0.011 |
| 26574 | 0.005 |
| 26575 | 0.003 |
| 26576 | 0.006 |
| 26577 | 0.01 |
| 26578 | 0.004 |
| 26579 | 0.006 |
| 26580 | 0.005 |
| 26581 | 0.004 |
| 26582 | 0.004 |
| 26583 | 0.004 |
| 26584 | 0.007 |
| 26585 | 0.002 |
| 26586 | 0.003 |
| 26587 | 0.002 |
| 26588 | 0.003 |
| 26589 | 0.002 |
| 26590 | 0.002 |
| 26591 | 0.003 |
| 26592 | 0.008 |
| 26593 | 0.003 |
| 26594 | 0.006 |
| 26595 | 0.004 |
| 26596 | 0.003 |
| 26597 | 0.002 |
| 26598 | 0.002 |
| 26599 | 0.01 |
| 26600 | 0.004 |
| 26601 | 0.003 |
| 26602 | 0.005 |
| 26603 | 0.004 |
| 26604 | 0.009 |
| 26605 | 0.009 |
| 26606 | 0.004 |
| 26607 | 0.001 |
| 26608 | 0.004 |
| 26609 | 0.004 |
| 26610 | 0.001 |
| 26611 | 0.001 |
| 26612 | 0.009 |
| 26613 | 0.007 |
| 26614 | 0.003 |
| 26615 | 0.004 |
| 26616 | 0.002 |
| 26617 | 0.005 |
| 26618 | 0.002 |
| 26619 | 0.003 |
| 26620 | 0.004 |
| 26621 | 0.006 |
| 26622 | 0.004 |
| 26623 | 0.004 |
| 26624 | 0.009 |
| 26625 | 0.009 |
| 26626 | 0.003 |
| 26627 | 0.003 |
| 26628 | 0.003 |
| 26629 | 0.006 |
| 26630 | 0.007 |
| 26631 | 0.004 |
| 26632 | 0.002 |
| 26633 | 0.003 |
| 26634 | 0.005 |
| 26635 | 0.006 |
| 26636 | 0.006 |
| 26637 | 0.007 |
| 26638 | 0.003 |
| 26639 | 0.002 |
| 26640 | 0.007 |
| 26641 | 0.009 |
| 26642 | 0.002 |
| 26643 | 0.004 |
| 26644 | 0.014 |
| 26645 | 0.008 |
| 26646 | 0.003 |
| 26647 | 0.006 |
| 26648 | 0.004 |
| 26649 | 0.005 |
| 26650 | 0.003 |
| 26651 | 0.001 |
| 26652 | 0.001 |
| 26653 | 0.007 |
| 26654 | 0.003 |
| 26655 | 0.007 |
| 26656 | 0.007 |
| 26657 | 0.008 |
| 26658 | 0.002 |
| 26659 | 0.003 |
| 26660 | 0.01 |
| 26661 | 0.005 |
| 26662 | 0.003 |
| 26663 | 0.001 |
| 26664 | 0.008 |
| 26665 | 0.009 |
| 26666 | 0.002 |
| 26667 | 0.003 |
| 26668 | 0.003 |
| 26669 | 0.002 |
| 26670 | 0.003 |
| 26671 | 0.002 |
| 26672 | 0.003 |
| 26673 | 0.003 |
| 26674 | 0.006 |
| 26675 | 0.005 |
| 26676 | 0.007 |
| 26677 | 0.003 |
| 26678 | 0.004 |
| 26679 | 0.003 |
| 26680 | 0.005 |
| 26681 | 0.003 |
| 26682 | 0.008 |
| 26683 | 0.004 |
| 26684 | 0.005 |
| 26685 | 0.003 |
| 26686 | 0.003 |
| 26687 | 0.006 |
| 26688 | 0.006 |
| 26689 | 0.004 |
| 26690 | 0.003 |
| 26691 | 0.006 |
| 26692 | 0.004 |
| 26693 | 0.002 |
| 26694 | 0.004 |
| 26695 | 0.004 |
| 26696 | 0.005 |
| 26697 | 0.001 |
| 26698 | 0.002 |
| 26699 | 0.01 |
| 26700 | 0.002 |
| 26701 | 0.005 |
| 26702 | 0.006 |
| 26703 | 0.008 |
| 26704 | 0.005 |
| 26705 | 0.002 |
| 26706 | 0.007 |
| 26707 | 0.008 |
| 26708 | 0.006 |
| 26709 | 0.003 |
| 26710 | 0.005 |
| 26711 | 0.003 |
| 26712 | 0.002 |
| 26713 | 0.002 |
| 26714 | 0.005 |
| 26715 | 0.003 |
| 26716 | 0.005 |
| 26717 | 0.003 |
| 26718 | 0.004 |
| 26719 | 0.005 |
| 26720 | 0.005 |
| 26721 | 0.002 |
| 26722 | 0.006 |
| 26723 | 0.006 |
| 26724 | 0.008 |
| 26725 | 0.002 |
| 26726 | 0.001 |
| 26727 | 0.002 |
| 26728 | 0.003 |
| 26729 | 0.003 |
| 26730 | 0.004 |
| 26731 | 0.007 |
| 26732 | 0.004 |
| 26733 | 0.003 |
| 26734 | 0.005 |
| 26735 | 0.002 |
| 26736 | 0.004 |
| 26737 | 0.003 |
| 26738 | 0.001 |
| 26739 | 0.005 |
| 26740 | 0.003 |
| 26741 | 0.004 |
| 26742 | 0.004 |
| 26743 | 0.003 |
| 26744 | 0.003 |
| 26745 | 0.001 |
| 26746 | 0.004 |
| 26747 | 0.004 |
| 26748 | 0.007 |
| 26749 | 0.005 |
| 26750 | 0.003 |
| 26751 | 0.006 |
| 26752 | 0.009 |
| 26753 | 0.003 |
| 26754 | 0.003 |
| 26755 | 0.003 |
| 26756 | 0.007 |
| 26757 | 0.002 |
| 26758 | 0.002 |
| 26759 | 0.004 |
| 26760 | 0.007 |
| 26761 | 0.004 |
| 26762 | 0.004 |
| 26763 | 0.004 |
| 26764 | 0.004 |
| 26765 | 0.003 |
| 26766 | 0.004 |
| 26767 | 0.007 |
| 26768 | 0.003 |
| 26769 | 0.004 |
| 26770 | 0.004 |
| 26771 | 0.003 |
| 26772 | 0.005 |
| 26773 | 0.003 |
| 26774 | 0.002 |
| 26775 | 0.006 |
| 26776 | 0.004 |
| 26777 | 0.003 |
| 26778 | 0.003 |
| 26779 | 0.003 |
| 26780 | 0.01 |
| 26781 | 0.003 |
| 26782 | 0.002 |
| 26783 | 0.003 |
| 26784 | 0.004 |
| 26785 | 0.006 |
| 26786 | 0.003 |
| 26787 | 0.006 |
| 26788 | 0.009 |
| 26789 | 0.008 |
| 26790 | 0.007 |
| 26791 | 0.003 |
| 26792 | 0.006 |
| 26793 | 0.008 |
| 26794 | 0.003 |
| 26795 | 0.002 |
| 26796 | 0.004 |
| 26797 | 0.008 |
| 26798 | 0.004 |
| 26799 | 0.008 |
| 26800 | 0.005 |
| 26801 | 0.004 |
| 26802 | 0.003 |
| 26803 | 0.008 |
| 26804 | 0.004 |
| 26805 | 0.001 |
| 26806 | 0.004 |
| 26807 | 0.002 |
| 26808 | 0.009 |
| 26809 | 0.01 |
| 26810 | 0.002 |
| 26811 | 0.001 |
| 26812 | 0.006 |
| 26813 | 0.008 |
| 26814 | 0.002 |
| 26815 | 0.002 |
| 26816 | 0.006 |
| 26817 | 0.009 |
| 26818 | 0.002 |
| 26819 | 0.001 |
| 26820 | 0.002 |
| 26821 | 0.004 |
| 26822 | 0.004 |
| 26823 | 0.004 |
| 26824 | 0.002 |
| 26825 | 0.01 |
| 26826 | 0.001 |
| 26827 | 0.006 |
| 26828 | 0.003 |
| 26829 | 0.01 |
| 26830 | 0.001 |
| 26831 | 0.001 |
| 26832 | 0.01 |
| 26833 | 0.007 |
| 26834 | 0.001 |
| 26835 | 0.001 |
| 26836 | 0.006 |
| 26837 | 0.008 |
| 26838 | 0.001 |
| 26839 | 0.002 |
| 26840 | 0.006 |
| 26841 | 0.002 |
| 26842 | 0.001 |
| 26843 | 0.005 |
| 26844 | 0.005 |
| 26845 | 0.008 |
| 26846 | 0.001 |
| 26847 | 0.003 |
| 26848 | 0.004 |
| 26849 | 0.004 |
| 26850 | 0.004 |
| 26851 | 0.005 |
| 26852 | 0.003 |
| 26853 | 0.003 |
| 26854 | 0.003 |
| 26855 | 0.006 |
| 26856 | 0.003 |
| 26857 | 0.005 |
| 26858 | 0.003 |
| 26859 | 0.002 |
| 26860 | 0.003 |
| 26861 | 0.007 |
| 26862 | 0.004 |
| 26863 | 0.003 |
| 26864 | 0.003 |
| 26865 | 0.005 |
| 26866 | 0.002 |
| 26867 | 0.005 |
| 26868 | 0.002 |
| 26869 | 0.004 |
| 26870 | 0.004 |
| 26871 | 0.003 |
| 26872 | 0.004 |
| 26873 | 0.004 |
| 26874 | 0.005 |
| 26875 | 0.004 |
| 26876 | 0.004 |
| 26877 | 0.004 |
| 26878 | 0.005 |
| 26879 | 0.008 |
| 26880 | 0.001 |
| 26881 | 0.002 |
| 26882 | 0.004 |
| 26883 | 0.005 |
| 26884 | 0.002 |
| 26885 | 0.007 |
| 26886 | 0.006 |
| 26887 | 0.007 |
| 26888 | 0.014 |
| 26889 | 0.009 |
| 26890 | 0.005 |
| 26891 | 0.001 |
| 26892 | 0.002 |
| 26893 | 0.004 |
| 26894 | 0.011 |
| 26895 | 0.003 |
| 26896 | 0.004 |
| 26897 | 0.004 |
| 26898 | 0.005 |
| 26899 | 0.008 |
| 26900 | 0.007 |
| 26901 | 0.003 |
| 26902 | 0.007 |
| 26903 | 0.01 |
| 26904 | 0.008 |
| 26905 | 0.003 |
| 26906 | 0.004 |
| 26907 | 0.005 |
| 26908 | 0.005 |
| 26909 | 0.006 |
| 26910 | 0.005 |
| 26911 | 0.001 |
| 26912 | 0.001 |
| 26913 | 0.007 |
| 26914 | 0.005 |
| 26915 | 0.005 |
| 26916 | 0.001 |
| 26917 | 0.003 |
| 26918 | 0.006 |
| 26919 | 0.005 |
| 26920 | 0.006 |
| 26921 | 0.003 |
| 26922 | 0.002 |
| 26923 | 0.003 |
| 26924 | 0.006 |
| 26925 | 0.002 |
| 26926 | 0.002 |
| 26927 | 0.002 |
| 26928 | 0.005 |
| 26929 | 0.004 |
| 26930 | 0.005 |
| 26931 | 0.004 |
| 26932 | 0.008 |
| 26933 | 0.005 |
| 26934 | 0.003 |
| 26935 | 0.003 |
| 26936 | 0.006 |
| 26937 | 0.008 |
| 26938 | 0.003 |
| 26939 | 0.003 |
| 26940 | 0.004 |
| 26941 | 0.003 |
| 26942 | 0.007 |
| 26943 | 0.002 |
| 26944 | 0.008 |
| 26945 | 0.012 |
| 26946 | 0.003 |
| 26947 | 0.004 |
| 26948 | 0.011 |
| 26949 | 0.006 |
| 26950 | 0.002 |
| 26951 | 0.003 |
| 26952 | 0.005 |
| 26953 | 0.004 |
| 26954 | 0.002 |
| 26955 | 0.003 |
| 26956 | 0.004 |
| 26957 | 0.003 |
| 26958 | 0.002 |
| 26959 | 0.004 |
| 26960 | 0.005 |
| 26961 | 0.008 |
| 26962 | 0.001 |
| 26963 | 0.007 |
| 26964 | 0.005 |
| 26965 | 0.007 |
| 26966 | 0.002 |
| 26967 | 0.004 |
| 26968 | 0.003 |
| 26969 | 0.002 |
| 26970 | 0.004 |
| 26971 | 0.002 |
| 26972 | 0.006 |
| 26973 | 0.009 |
| 26974 | 0.003 |
| 26975 | 0.002 |
| 26976 | 0.002 |
| 26977 | 0.006 |
| 26978 | 0.003 |
| 26979 | 0.002 |
| 26980 | 0.005 |
| 26981 | 0.005 |
| 26982 | 0.003 |
| 26983 | 0.001 |
| 26984 | 0.003 |
| 26985 | 0.003 |
| 26986 | 0.006 |
| 26987 | 0.004 |
| 26988 | 0.002 |
| 26989 | 0.003 |
| 26990 | 0.003 |
| 26991 | 0.002 |
| 26992 | 0.002 |
| 26993 | 0.005 |
| 26994 | 0.003 |
| 26995 | 0.005 |
| 26996 | 0.004 |
| 26997 | 0.004 |
| 26998 | 0.002 |
| 26999 | 0.003 |
| 27000 | 0.004 |
| 27001 | 0.006 |
| 27002 | 0 |
| 27003 | 0.002 |
| 27004 | 0.004 |
| 27005 | 0.003 |
| 27006 | 0.003 |
| 27007 | 0.005 |
| 27008 | 0.005 |
| 27009 | 0.005 |
| 27010 | 0.002 |
| 27011 | 0.006 |
| 27012 | 0.005 |
| 27013 | 0.001 |
| 27014 | 0.005 |
| 27015 | 0.011 |
| 27016 | 0.006 |
| 27017 | 0.001 |
| 27018 | 0.002 |
| 27019 | 0.003 |
| 27020 | 0.003 |
| 27021 | 0.001 |
| 27022 | 0.004 |
| 27023 | 0.005 |
| 27024 | 0.011 |
| 27025 | 0.004 |
| 27026 | 0.003 |
| 27027 | 0.004 |
| 27028 | 0.005 |
| 27029 | 0.002 |
| 27030 | 0.004 |
| 27031 | 0.005 |
| 27032 | 0.004 |
| 27033 | 0.006 |
| 27034 | 0.002 |
| 27035 | 0.002 |
| 27036 | 0.003 |
| 27037 | 0.002 |
| 27038 | 0.003 |
| 27039 | 0.005 |
| 27040 | 0.009 |
| 27041 | 0.003 |
| 27042 | 0.007 |
| 27043 | 0.001 |
| 27044 | 0.005 |
| 27045 | 0.004 |
| 27046 | 0.003 |
| 27047 | 0.002 |
| 27048 | 0.006 |
| 27049 | 0.002 |
| 27050 | 0.002 |
| 27051 | 0.002 |
| 27052 | 0.003 |
| 27053 | 0.003 |
| 27054 | 0.002 |
| 27055 | 0.003 |
| 27056 | 0.005 |
| 27057 | 0.004 |
| 27058 | 0.001 |
| 27059 | 0.002 |
| 27060 | 0.002 |
| 27061 | 0.003 |
| 27062 | 0.003 |
| 27063 | 0.003 |
| 27064 | 0.003 |
| 27065 | 0.005 |
| 27066 | 0.002 |
| 27067 | 0.007 |
| 27068 | 0.006 |
| 27069 | 0.002 |
| 27070 | 0.001 |
| 27071 | 0.004 |
| 27072 | 0.004 |
| 27073 | 0.007 |
| 27074 | 0.006 |
| 27075 | 0.002 |
| 27076 | 0.002 |
| 27077 | 0.008 |
| 27078 | 0.003 |
| 27079 | 0.005 |
| 27080 | 0.004 |
| 27081 | 0.009 |
| 27082 | 0.001 |
| 27083 | 0.002 |
| 27084 | 0.008 |
| 27085 | 0.004 |
| 27086 | 0.005 |
| 27087 | 0.004 |
| 27088 | 0.005 |
| 27089 | 0.003 |
| 27090 | 0.003 |
| 27091 | 0.002 |
| 27092 | 0.004 |
| 27093 | 0.005 |
| 27094 | 0.001 |
| 27095 | 0.002 |
| 27096 | 0.005 |
| 27097 | 0.007 |
| 27098 | 0.002 |
| 27099 | 0.002 |
| 27100 | 0.007 |
| 27101 | 0.005 |
| 27102 | 0.006 |
| 27103 | 0.009 |
| 27104 | 0.005 |
| 27105 | 0.003 |
| 27106 | 0.002 |
| 27107 | 0.004 |
| 27108 | 0.005 |
| 27109 | 0.002 |
| 27110 | 0.002 |
| 27111 | 0.005 |
| 27112 | 0.004 |
| 27113 | 0.004 |
| 27114 | 0.002 |
| 27115 | 0.004 |
| 27116 | 0.006 |
| 27117 | 0.003 |
| 27118 | 0.006 |
| 27119 | 0.006 |
| 27120 | 0.006 |
| 27121 | 0.008 |
| 27122 | 0.004 |
| 27123 | 0.005 |
| 27124 | 0.006 |
| 27125 | 0.003 |
| 27126 | 0.005 |
| 27127 | 0.006 |
| 27128 | 0.003 |
| 27129 | 0.006 |
| 27130 | 0.007 |
| 27131 | 0.005 |
| 27132 | 0.009 |
| 27133 | 0.002 |
| 27134 | 0.002 |
| 27135 | 0.01 |
| 27136 | 0.007 |
| 27137 | 0.002 |
| 27138 | 0.003 |
| 27139 | 0.006 |
| 27140 | 0.007 |
| 27141 | 0.002 |
| 27142 | 0.002 |
| 27143 | 0.004 |
| 27144 | 0.004 |
| 27145 | 0.007 |
| 27146 | 0.003 |
| 27147 | 0.005 |
| 27148 | 0.01 |
| 27149 | 0.003 |
| 27150 | 0.002 |
| 27151 | 0.002 |
| 27152 | 0.001 |
| 27153 | 0.004 |
| 27154 | 0.002 |
| 27155 | 0.002 |
| 27156 | 0.006 |
| 27157 | 0.003 |
| 27158 | 0.001 |
| 27159 | 0.004 |
| 27160 | 0.001 |
| 27161 | 0.006 |
| 27162 | 0.003 |
| 27163 | 0.004 |
| 27164 | 0.002 |
| 27165 | 0.002 |
| 27166 | 0.002 |
| 27167 | 0.006 |
| 27168 | 0.003 |
| 27169 | 0.003 |
| 27170 | 0.002 |
| 27171 | 0.004 |
| 27172 | 0.002 |
| 27173 | 0.004 |
| 27174 | 0.002 |
| 27175 | 0.003 |
| 27176 | 0.003 |
| 27177 | 0.003 |
| 27178 | 0.006 |
| 27179 | 0.002 |
| 27180 | 0.005 |
| 27181 | 0.001 |
| 27182 | 0.002 |
| 27183 | 0.002 |
| 27184 | 0.002 |
| 27185 | 0.002 |
| 27186 | 0.002 |
| 27187 | 0.004 |
| 27188 | 0.002 |
| 27189 | 0.005 |
| 27190 | 0.003 |
| 27191 | 0.004 |
| 27192 | 0.003 |
| 27193 | 0.002 |
| 27194 | 0.004 |
| 27195 | 0.006 |
| 27196 | 0.008 |
| 27197 | 0.001 |
| 27198 | 0.007 |
| 27199 | 0.003 |
| 27200 | 0.003 |
| 27201 | 0.006 |
| 27202 | 0.003 |
| 27203 | 0.005 |
| 27204 | 0.001 |
| 27205 | 0.005 |
| 27206 | 0.006 |
| 27207 | 0.01 |
| 27208 | 0.006 |
| 27209 | 0.004 |
| 27210 | 0.005 |
| 27211 | 0.003 |
| 27212 | 0.002 |
| 27213 | 0.003 |
| 27214 | 0.005 |
| 27215 | 0.005 |
| 27216 | 0.006 |
| 27217 | 0.007 |
| 27218 | 0.007 |
| 27219 | 0.009 |
| 27220 | 0.005 |
| 27221 | 0.003 |
| 27222 | 0.003 |
| 27223 | 0.003 |
| 27224 | 0.004 |
| 27225 | 0.003 |
| 27226 | 0.01 |
| 27227 | 0.01 |
| 27228 | 0.005 |
| 27229 | 0.009 |
| 27230 | 0.007 |
| 27231 | 0.007 |
| 27232 | 0.003 |
| 27233 | 0.005 |
| 27234 | 0.002 |
| 27235 | 0.003 |
| 27236 | 0.006 |
| 27237 | 0.002 |
| 27238 | 0.004 |
| 27239 | 0.007 |
| 27240 | 0.002 |
| 27241 | 0.005 |
| 27242 | 0.006 |
| 27243 | 0.008 |
| 27244 | 0.006 |
| 27245 | 0.006 |
| 27246 | 0.003 |
| 27247 | 0.002 |
| 27248 | 0.003 |
| 27249 | 0.006 |
| 27250 | 0.01 |
| 27251 | 0.005 |
| 27252 | 0.006 |
| 27253 | 0.007 |
| 27254 | 0.007 |
| 27255 | 0.005 |
| 27256 | 0.003 |
| 27257 | 0.005 |
| 27258 | 0.008 |
| 27259 | 0.004 |
| 27260 | 0.005 |
| 27261 | 0.002 |
| 27262 | 0.004 |
| 27263 | 0.008 |
| 27264 | 0.001 |
| 27265 | 0.003 |
| 27266 | 0.005 |
| 27267 | 0.007 |
| 27268 | 0.007 |
| 27269 | 0.003 |
| 27270 | 0.003 |
| 27271 | 0.005 |
| 27272 | 0.001 |
| 27273 | 0.004 |
| 27274 | 0.008 |
| 27275 | 0.007 |
| 27276 | 0.005 |
| 27277 | 0.002 |
| 27278 | 0.003 |
| 27279 | 0.003 |
| 27280 | 0.003 |
| 27281 | 0.002 |
| 27282 | 0.001 |
| 27283 | 0.006 |
| 27284 | 0.008 |
| 27285 | 0.002 |
| 27286 | 0.006 |
| 27287 | 0.006 |
| 27288 | 0.006 |
| 27289 | 0.004 |
| 27290 | 0.002 |
| 27291 | 0.004 |
| 27292 | 0.011 |
| 27293 | 0.003 |
| 27294 | 0.009 |
| 27295 | 0.009 |
| 27296 | 0.007 |
| 27297 | 0.002 |
| 27298 | 0.003 |
| 27299 | 0.004 |
| 27300 | 0.003 |
| 27301 | 0.002 |
| 27302 | 0.005 |
| 27303 | 0.005 |
| 27304 | 0.003 |
| 27305 | 0.003 |
| 27306 | 0.004 |
| 27307 | 0.005 |
| 27308 | 0.002 |
| 27309 | 0.003 |
| 27310 | 0.005 |
| 27311 | 0.003 |
| 27312 | 0.004 |
| 27313 | 0.004 |
| 27314 | 0.005 |
| 27315 | 0.005 |
| 27316 | 0.003 |
| 27317 | 0.004 |
| 27318 | 0.003 |
| 27319 | 0.003 |
| 27320 | 0.006 |
| 27321 | 0.002 |
| 27322 | 0.002 |
| 27323 | 0.003 |
| 27324 | 0.003 |
| 27325 | 0.004 |
| 27326 | 0.002 |
| 27327 | 0.004 |
| 27328 | 0.003 |
| 27329 | 0.001 |
| 27330 | 0.004 |
| 27331 | 0.005 |
| 27332 | 0.003 |
| 27333 | 0.008 |
| 27334 | 0.004 |
| 27335 | 0.003 |
| 27336 | 0.002 |
| 27337 | 0.003 |
| 27338 | 0.003 |
| 27339 | 0.004 |
| 27340 | 0.004 |
| 27341 | 0.002 |
| 27342 | 0.002 |
| 27343 | 0.004 |
| 27344 | 0.004 |
| 27345 | 0.004 |
| 27346 | 0.001 |
| 27347 | 0.005 |
| 27348 | 0.006 |
| 27349 | 0.008 |
| 27350 | 0.003 |
| 27351 | 0.003 |
| 27352 | 0.004 |
| 27353 | 0.009 |
| 27354 | 0.003 |
| 27355 | 0.002 |
| 27356 | 0.001 |
| 27357 | 0.003 |
| 27358 | 0.003 |
| 27359 | 0.004 |
| 27360 | 0.009 |
| 27361 | 0.003 |
| 27362 | 0.005 |
| 27363 | 0.003 |
| 27364 | 0.004 |
| 27365 | 0.006 |
| 27366 | 0.003 |
| 27367 | 0.004 |
| 27368 | 0.004 |
| 27369 | 0.001 |
| 27370 | 0.004 |
| 27371 | 0.005 |
| 27372 | 0.01 |
| 27373 | 0.006 |
| 27374 | 0.004 |
| 27375 | 0.004 |
| 27376 | 0.004 |
| 27377 | 0.004 |
| 27378 | 0.002 |
| 27379 | 0.007 |
| 27380 | 0.008 |
| 27381 | 0.004 |
| 27382 | 0.002 |
| 27383 | 0.004 |
| 27384 | 0.004 |
| 27385 | 0.004 |
| 27386 | 0.004 |
| 27387 | 0.004 |
| 27388 | 0.005 |
| 27389 | 0.007 |
| 27390 | 0.003 |
| 27391 | 0.005 |
| 27392 | 0.007 |
| 27393 | 0.005 |
| 27394 | 0.004 |
| 27395 | 0.007 |
| 27396 | 0.006 |
| 27397 | 0.005 |
| 27398 | 0.004 |
| 27399 | 0.003 |
| 27400 | 0.004 |
| 27401 | 0.005 |
| 27402 | 0.004 |
| 27403 | 0.003 |
| 27404 | 0.003 |
| 27405 | 0.006 |
| 27406 | 0.004 |
| 27407 | 0.006 |
| 27408 | 0.006 |
| 27409 | 0.002 |
| 27410 | 0.004 |
| 27411 | 0.005 |
| 27412 | 0.005 |
| 27413 | 0.001 |
| 27414 | 0.007 |
| 27415 | 0.004 |
| 27416 | 0.003 |
| 27417 | 0.003 |
| 27418 | 0.003 |
| 27419 | 0.005 |
| 27420 | 0.007 |
| 27421 | 0.003 |
| 27422 | 0.002 |
| 27423 | 0.001 |
| 27424 | 0.007 |
| 27425 | 0.001 |
| 27426 | 0.002 |
| 27427 | 0.008 |
| 27428 | 0.005 |
| 27429 | 0.003 |
| 27430 | 0.003 |
| 27431 | 0.004 |
| 27432 | 0.006 |
| 27433 | 0.003 |
| 27434 | 0.007 |
| 27435 | 0.008 |
| 27436 | 0.01 |
| 27437 | 0.006 |
| 27438 | 0.003 |
| 27439 | 0.004 |
| 27440 | 0.004 |
| 27441 | 0.002 |
| 27442 | 0.005 |
| 27443 | 0.004 |
| 27444 | 0.007 |
| 27445 | 0.001 |
| 27446 | 0.006 |
| 27447 | 0.005 |
| 27448 | 0.005 |
| 27449 | 0.003 |
| 27450 | 0.002 |
| 27451 | 0.002 |
| 27452 | 0.004 |
| 27453 | 0.004 |
| 27454 | 0.002 |
| 27455 | 0.01 |
| 27456 | 0.005 |
| 27457 | 0.006 |
| 27458 | 0.003 |
| 27459 | 0.002 |
| 27460 | 0.004 |
| 27461 | 0.003 |
| 27462 | 0.002 |
| 27463 | 0.002 |
| 27464 | 0.005 |
| 27465 | 0.005 |
| 27466 | 0.002 |
| 27467 | 0.003 |
| 27468 | 0.003 |
| 27469 | 0.003 |
| 27470 | 0.002 |
| 27471 | 0.003 |
| 27472 | 0.003 |
| 27473 | 0.007 |
| 27474 | 0.001 |
| 27475 | 0.004 |
| 27476 | 0.001 |
| 27477 | 0.001 |
| 27478 | 0.001 |
| 27479 | 0.002 |
| 27480 | 0.008 |
| 27481 | 0.003 |
| 27482 | 0.004 |
| 27483 | 0.002 |
| 27484 | 0.006 |
| 27485 | 0.003 |
| 27486 | 0.005 |
| 27487 | 0.006 |
| 27488 | 0.002 |
| 27489 | 0.006 |
| 27490 | 0.002 |
| 27491 | 0.003 |
| 27492 | 0.005 |
| 27493 | 0.002 |
| 27494 | 0.002 |
| 27495 | 0.001 |
| 27496 | 0.004 |
| 27497 | 0.003 |
| 27498 | 0.005 |
| 27499 | 0.002 |
| 27500 | 0.004 |
| 27501 | 0.003 |
| 27502 | 0.004 |
| 27503 | 0.002 |
| 27504 | 0.002 |
| 27505 | 0.003 |
| 27506 | 0.005 |
| 27507 | 0.003 |
| 27508 | 0.001 |
| 27509 | 0.006 |
| 27510 | 0.002 |
| 27511 | 0.006 |
| 27512 | 0.006 |
| 27513 | 0.008 |
| 27514 | 0.006 |
| 27515 | 0.008 |
| 27516 | 0.009 |
| 27517 | 0.004 |
| 27518 | 0.008 |
| 27519 | 0.007 |
| 27520 | 0.006 |
| 27521 | 0.004 |
| 27522 | 0.005 |
| 27523 | 0.006 |
| 27524 | 0.004 |
| 27525 | 0.004 |
| 27526 | 0.003 |
| 27527 | 0.004 |
| 27528 | 0.005 |
| 27529 | 0.003 |
| 27530 | 0.007 |
| 27531 | 0.002 |
| 27532 | 0.005 |
| 27533 | 0.004 |
| 27534 | 0.007 |
| 27535 | 0.004 |
| 27536 | 0.008 |
| 27537 | 0.007 |
| 27538 | 0.014 |
| 27539 | 0.003 |
| 27540 | 0.005 |
| 27541 | 0.001 |
| 27542 | 0.003 |
| 27543 | 0.004 |
| 27544 | 0.008 |
| 27545 | 0.006 |
| 27546 | 0.005 |
| 27547 | 0.001 |
| 27548 | 0.001 |
| 27549 | 0.004 |
| 27550 | 0.008 |
| 27551 | 0.001 |
| 27552 | 0.005 |
| 27553 | 0.002 |
| 27554 | 0.001 |
| 27555 | 0.004 |
| 27556 | 0.003 |
| 27557 | 0.009 |
| 27558 | 0.002 |
| 27559 | 0.002 |
| 27560 | 0.005 |
| 27561 | 0.001 |
| 27562 | 0.003 |
| 27563 | 0.002 |
| 27564 | 0.006 |
| 27565 | 0.003 |
| 27566 | 0.001 |
| 27567 | 0.001 |
| 27568 | 0.002 |
| 27569 | 0.002 |
| 27570 | 0.001 |
| 27571 | 0.004 |
| 27572 | 0.002 |
| 27573 | 0.005 |
| 27574 | 0.008 |
| 27575 | 0.002 |
| 27576 | 0.003 |
| 27577 | 0.001 |
| 27578 | 0.006 |
| 27579 | 0.004 |
| 27580 | 0.004 |
| 27581 | 0.002 |
| 27582 | 0.002 |
| 27583 | 0.002 |
| 27584 | 0.005 |
| 27585 | 0.004 |
| 27586 | 0.005 |
| 27587 | 0.002 |
| 27588 | 0.005 |
| 27589 | 0.002 |
| 27590 | 0.002 |
| 27591 | 0.005 |
| 27592 | 0.006 |
| 27593 | 0.009 |
| 27594 | 0.003 |
| 27595 | 0.004 |
| 27596 | 0.001 |
| 27597 | 0.008 |
| 27598 | 0.001 |
| 27599 | 0.004 |
| 27600 | 0.006 |
| 27601 | 0.01 |
| 27602 | 0.002 |
| 27603 | 0.002 |
| 27604 | 0.003 |
| 27605 | 0.004 |
| 27606 | 0.002 |
| 27607 | 0.002 |
| 27608 | 0.001 |
| 27609 | 0.003 |
| 27610 | 0.004 |
| 27611 | 0.002 |
| 27612 | 0.004 |
| 27613 | 0.007 |
| 27614 | 0.002 |
| 27615 | 0.007 |
| 27616 | 0.012 |
| 27617 | 0.002 |
| 27618 | 0.002 |
| 27619 | 0.004 |
| 27620 | 0.005 |
| 27621 | 0.003 |
| 27622 | 0.004 |
| 27623 | 0.008 |
| 27624 | 0.01 |
| 27625 | 0.002 |
| 27626 | 0.003 |
| 27627 | 0.005 |
| 27628 | 0.008 |
| 27629 | 0.003 |
| 27630 | 0.004 |
| 27631 | 0.002 |
| 27632 | 0.001 |
| 27633 | 0.002 |
| 27634 | 0.003 |
| 27635 | 0.005 |
| 27636 | 0.009 |
| 27637 | 0.002 |
| 27638 | 0.002 |
| 27639 | 0.006 |
| 27640 | 0.004 |
| 27641 | 0.002 |
| 27642 | 0.003 |
| 27643 | 0.008 |
| 27644 | 0.007 |
| 27645 | 0.001 |
| 27646 | 0.007 |
| 27647 | 0.005 |
| 27648 | 0.005 |
| 27649 | 0.004 |
| 27650 | 0.004 |
| 27651 | 0.006 |
| 27652 | 0.004 |
| 27653 | 0.004 |
| 27654 | 0.003 |
| 27655 | 0.003 |
| 27656 | 0.009 |
| 27657 | 0.004 |
| 27658 | 0.005 |
| 27659 | 0.004 |
| 27660 | 0.005 |
| 27661 | 0.003 |
| 27662 | 0.002 |
| 27663 | 0.003 |
| 27664 | 0.003 |
| 27665 | 0.001 |
| 27666 | 0.002 |
| 27667 | 0.005 |
| 27668 | 0.002 |
| 27669 | 0.002 |
| 27670 | 0.005 |
| 27671 | 0.01 |
| 27672 | 0.008 |
| 27673 | 0.002 |
| 27674 | 0.005 |
| 27675 | 0.01 |
| 27676 | 0.013 |
| 27677 | 0.002 |
| 27678 | 0 |
| 27679 | 0.003 |
| 27680 | 0.007 |
| 27681 | 0.005 |
| 27682 | 0.005 |
| 27683 | 0.01 |
| 27684 | 0.01 |
| 27685 | 0.001 |
| 27686 | 0.004 |
| 27687 | 0.003 |
| 27688 | 0.004 |
| 27689 | 0.002 |
| 27690 | 0.002 |
| 27691 | 0.003 |
| 27692 | 0.004 |
| 27693 | 0.002 |
| 27694 | 0.003 |
| 27695 | 0.004 |
| 27696 | 0.002 |
| 27697 | 0.004 |
| 27698 | 0.003 |
| 27699 | 0.002 |
| 27700 | 0.002 |
| 27701 | 0.003 |
| 27702 | 0.006 |
| 27703 | 0.008 |
| 27704 | 0.005 |
| 27705 | 0.002 |
| 27706 | 0.003 |
| 27707 | 0.003 |
| 27708 | 0.003 |
| 27709 | 0.004 |
| 27710 | 0.003 |
| 27711 | 0.003 |
| 27712 | 0.005 |
| 27713 | 0.005 |
| 27714 | 0.002 |
| 27715 | 0.003 |
| 27716 | 0.004 |
| 27717 | 0.012 |
| 27718 | 0.003 |
| 27719 | 0.002 |
| 27720 | 0.005 |
| 27721 | 0.005 |
| 27722 | 0.002 |
| 27723 | 0.003 |
| 27724 | 0.011 |
| 27725 | 0.006 |
| 27726 | 0.003 |
| 27727 | 0.003 |
| 27728 | 0.004 |
| 27729 | 0.002 |
| 27730 | 0.004 |
| 27731 | 0.003 |
| 27732 | 0.004 |
| 27733 | 0.007 |
| 27734 | 0.005 |
| 27735 | 0.004 |
| 27736 | 0.005 |
| 27737 | 0.002 |
| 27738 | 0.002 |
| 27739 | 0.004 |
| 27740 | 0.007 |
| 27741 | 0.003 |
| 27742 | 0.003 |
| 27743 | 0.003 |
| 27744 | 0.007 |
| 27745 | 0.005 |
| 27746 | 0.003 |
| 27747 | 0.003 |
| 27748 | 0.003 |
| 27749 | 0.004 |
| 27750 | 0.004 |
| 27751 | 0.006 |
| 27752 | 0.006 |
| 27753 | 0.008 |
| 27754 | 0.003 |
| 27755 | 0.004 |
| 27756 | 0.004 |
| 27757 | 0.007 |
| 27758 | 0.002 |
| 27759 | 0.004 |
| 27760 | 0.005 |
| 27761 | 0.004 |
| 27762 | 0.007 |
| 27763 | 0.004 |
| 27764 | 0.002 |
| 27765 | 0.004 |
| 27766 | 0.002 |
| 27767 | 0.005 |
| 27768 | 0.004 |
| 27769 | 0.005 |
| 27770 | 0.003 |
| 27771 | 0.001 |
| 27772 | 0.002 |
| 27773 | 0.01 |
| 27774 | 0.002 |
| 27775 | 0.004 |
| 27776 | 0.01 |
| 27777 | 0.006 |
| 27778 | 0.002 |
| 27779 | 0.002 |
| 27780 | 0.003 |
| 27781 | 0.003 |
| 27782 | 0.002 |
| 27783 | 0.003 |
| 27784 | 0.001 |
| 27785 | 0.006 |
| 27786 | 0.004 |
| 27787 | 0.005 |
| 27788 | 0.001 |
| 27789 | 0.003 |
| 27790 | 0.003 |
| 27791 | 0.001 |
| 27792 | 0.003 |
| 27793 | 0.004 |
| 27794 | 0.008 |
| 27795 | 0.004 |
| 27796 | 0.005 |
| 27797 | 0.002 |
| 27798 | 0.004 |
| 27799 | 0.005 |
| 27800 | 0.001 |
| 27801 | 0.007 |
| 27802 | 0.001 |
| 27803 | 0.004 |
| 27804 | 0.004 |
| 27805 | 0.001 |
| 27806 | 0.003 |
| 27807 | 0.004 |
| 27808 | 0.003 |
| 27809 | 0.004 |
| 27810 | 0.006 |
| 27811 | 0.002 |
| 27812 | 0.002 |
| 27813 | 0.003 |
| 27814 | 0.005 |
| 27815 | 0.006 |
| 27816 | 0.003 |
| 27817 | 0.006 |
| 27818 | 0.008 |
| 27819 | 0.003 |
| 27820 | 0.004 |
| 27821 | 0.004 |
| 27822 | 0.005 |
| 27823 | 0.009 |
| 27824 | 0.009 |
| 27825 | 0.009 |
| 27826 | 0.005 |
| 27827 | 0.003 |
| 27828 | 0.004 |
| 27829 | 0.004 |
| 27830 | 0.008 |
| 27831 | 0.002 |
| 27832 | 0.006 |
| 27833 | 0.004 |
| 27834 | 0.001 |
| 27835 | 0.009 |
| 27836 | 0.006 |
| 27837 | 0.013 |
| 27838 | 0.002 |
| 27839 | 0.003 |
| 27840 | 0.008 |
| 27841 | 0.012 |
| 27842 | 0.01 |
| 27843 | 0.006 |
| 27844 | 0.008 |
| 27845 | 0.007 |
| 27846 | 0.005 |
| 27847 | 0.008 |
| 27848 | 0.005 |
| 27849 | 0.006 |
| 27850 | 0.001 |
| 27851 | 0.005 |
| 27852 | 0.002 |
| 27853 | 0.005 |
| 27854 | 0.005 |
| 27855 | 0.01 |
| 27856 | 0.005 |
| 27857 | 0.005 |
| 27858 | 0.007 |
| 27859 | 0.009 |
| 27860 | 0.003 |
| 27861 | 0.002 |
| 27862 | 0.008 |
| 27863 | 0.008 |
| 27864 | 0.007 |
| 27865 | 0.004 |
| 27866 | 0.005 |
| 27867 | 0.005 |
| 27868 | 0.002 |
| 27869 | 0.003 |
| 27870 | 0.004 |
| 27871 | 0.003 |
| 27872 | 0.003 |
| 27873 | 0.002 |
| 27874 | 0.007 |
| 27875 | 0.009 |
| 27876 | 0.003 |
| 27877 | 0.002 |
| 27878 | 0.003 |
| 27879 | 0.003 |
| 27880 | 0.005 |
| 27881 | 0.004 |
| 27882 | 0.008 |
| 27883 | 0.004 |
| 27884 | 0.003 |
| 27885 | 0.003 |
| 27886 | 0.004 |
| 27887 | 0.006 |
| 27888 | 0.001 |
| 27889 | 0.003 |
| 27890 | 0.002 |
| 27891 | 0.007 |
| 27892 | 0.003 |
| 27893 | 0.003 |
| 27894 | 0.002 |
| 27895 | 0.01 |
| 27896 | 0.011 |
| 27897 | 0.002 |
| 27898 | 0.004 |
| 27899 | 0.005 |
| 27900 | 0.004 |
| 27901 | 0.002 |
| 27902 | 0.002 |
| 27903 | 0.006 |
| 27904 | 0.004 |
| 27905 | 0.007 |
| 27906 | 0.008 |
| 27907 | 0.004 |
| 27908 | 0.004 |
| 27909 | 0.01 |
| 27910 | 0.002 |
| 27911 | 0.004 |
| 27912 | 0.002 |
| 27913 | 0.007 |
| 27914 | 0.002 |
| 27915 | 0.005 |
| 27916 | 0.001 |
| 27917 | 0.008 |
| 27918 | 0.004 |
| 27919 | 0.006 |
| 27920 | 0.01 |
| 27921 | 0.012 |
| 27922 | 0.002 |
| 27923 | 0.006 |
| 27924 | 0.008 |
| 27925 | 0.004 |
| 27926 | 0.003 |
| 27927 | 0.003 |
| 27928 | 0.004 |
| 27929 | 0.006 |
| 27930 | 0.001 |
| 27931 | 0.001 |
| 27932 | 0.007 |
| 27933 | 0.008 |
| 27934 | 0.007 |
| 27935 | 0.002 |
| 27936 | 0.004 |
| 27937 | 0.006 |
| 27938 | 0.001 |
| 27939 | 0.003 |
| 27940 | 0.002 |
| 27941 | 0.005 |
| 27942 | 0.004 |
| 27943 | 0.002 |
| 27944 | 0.004 |
| 27945 | 0.012 |
| 27946 | 0.001 |
| 27947 | 0.005 |
| 27948 | 0.007 |
| 27949 | 0.009 |
| 27950 | 0.004 |
| 27951 | 0.003 |
| 27952 | 0.005 |
| 27953 | 0.006 |
| 27954 | 0.001 |
| 27955 | 0.001 |
| 27956 | 0.004 |
| 27957 | 0.002 |
| 27958 | 0 |
| 27959 | 0.002 |
| 27960 | 0.005 |
| 27961 | 0.008 |
| 27962 | 0.002 |
| 27963 | 0.006 |
| 27964 | 0.008 |
| 27965 | 0.004 |
| 27966 | 0.004 |
| 27967 | 0.005 |
| 27968 | 0.004 |
| 27969 | 0.002 |
| 27970 | 0.002 |
| 27971 | 0.002 |
| 27972 | 0.007 |
| 27973 | 0.002 |
| 27974 | 0.001 |
| 27975 | 0.005 |
| 27976 | 0.005 |
| 27977 | 0.003 |
| 27978 | 0.004 |
| 27979 | 0.01 |
| 27980 | 0.009 |
| 27981 | 0.005 |
| 27982 | 0.004 |
| 27983 | 0.002 |
| 27984 | 0.002 |
| 27985 | 0.006 |
| 27986 | 0.002 |
| 27987 | 0.004 |
| 27988 | 0.004 |
| 27989 | 0.005 |
| 27990 | 0.007 |
| 27991 | 0.004 |
| 27992 | 0.001 |
| 27993 | 0.001 |
| 27994 | 0.002 |
| 27995 | 0.002 |
| 27996 | 0.008 |
| 27997 | 0.002 |
| 27998 | 0.002 |
| 27999 | 0.003 |
| 28000 | 0.009 |
| 28001 | 0.003 |
| 28002 | 0.005 |
| 28003 | 0.003 |
| 28004 | 0.008 |
| 28005 | 0.002 |
| 28006 | 0.002 |
| 28007 | 0.005 |
| 28008 | 0.005 |
| 28009 | 0.002 |
| 28010 | 0.002 |
| 28011 | 0.003 |
| 28012 | 0.005 |
| 28013 | 0.002 |
| 28014 | 0.003 |
| 28015 | 0.006 |
| 28016 | 0.007 |
| 28017 | 0.003 |
| 28018 | 0.003 |
| 28019 | 0.007 |
| 28020 | 0.003 |
| 28021 | 0.002 |
| 28022 | 0.001 |
| 28023 | 0.003 |
| 28024 | 0.002 |
| 28025 | 0.003 |
| 28026 | 0.003 |
| 28027 | 0.002 |
| 28028 | 0.01 |
| 28029 | 0.004 |
| 28030 | 0.005 |
| 28031 | 0.004 |
| 28032 | 0.002 |
| 28033 | 0.002 |
| 28034 | 0.002 |
| 28035 | 0.004 |
| 28036 | 0.003 |
| 28037 | 0.002 |
| 28038 | 0.003 |
| 28039 | 0.003 |
| 28040 | 0.005 |
| 28041 | 0.002 |
| 28042 | 0.002 |
| 28043 | 0.006 |
| 28044 | 0.003 |
| 28045 | 0.002 |
| 28046 | 0.007 |
| 28047 | 0.005 |
| 28048 | 0.01 |
| 28049 | 0.001 |
| 28050 | 0.006 |
| 28051 | 0.008 |
| 28052 | 0.014 |
| 28053 | 0.002 |
| 28054 | 0.005 |
| 28055 | 0.004 |
| 28056 | 0.002 |
| 28057 | 0.006 |
| 28058 | 0.004 |
| 28059 | 0.001 |
| 28060 | 0.007 |
| 28061 | 0.003 |
| 28062 | 0.003 |
| 28063 | 0.014 |
| 28064 | 0.007 |
| 28065 | 0.002 |
| 28066 | 0.003 |
| 28067 | 0.008 |
| 28068 | 0.008 |
| 28069 | 0.001 |
| 28070 | 0.004 |
| 28071 | 0.006 |
| 28072 | 0.002 |
| 28073 | 0.008 |
| 28074 | 0.002 |
| 28075 | 0.001 |
| 28076 | 0.01 |
| 28077 | 0.011 |
| 28078 | 0.004 |
| 28079 | 0.002 |
| 28080 | 0.003 |
| 28081 | 0.005 |
| 28082 | 0.002 |
| 28083 | 0.002 |
| 28084 | 0.005 |
| 28085 | 0.007 |
| 28086 | 0.002 |
| 28087 | 0.003 |
| 28088 | 0.003 |
| 28089 | 0.004 |
| 28090 | 0.004 |
| 28091 | 0.006 |
| 28092 | 0.002 |
| 28093 | 0.006 |
| 28094 | 0.005 |
| 28095 | 0.005 |
| 28096 | 0.005 |
| 28097 | 0.003 |
| 28098 | 0.005 |
| 28099 | 0.01 |
| 28100 | 0.006 |
| 28101 | 0.004 |
| 28102 | 0.006 |
| 28103 | 0.007 |
| 28104 | 0.003 |
| 28105 | 0.004 |
| 28106 | 0.004 |
| 28107 | 0.004 |
| 28108 | 0.006 |
| 28109 | 0.009 |
| 28110 | 0.004 |
| 28111 | 0.005 |
| 28112 | 0.004 |
| 28113 | 0.002 |
| 28114 | 0.001 |
| 28115 | 0.007 |
| 28116 | 0.007 |
| 28117 | 0.004 |
| 28118 | 0.002 |
| 28119 | 0.004 |
| 28120 | 0.008 |
| 28121 | 0.003 |
| 28122 | 0.003 |
| 28123 | 0.004 |
| 28124 | 0 |
| 28125 | 0.002 |
| 28126 | 0.002 |
| 28127 | 0.005 |
| 28128 | 0.007 |
| 28129 | 0.008 |
| 28130 | 0.005 |
| 28131 | 0.006 |
| 28132 | 0.002 |
| 28133 | 0.004 |
| 28134 | 0.006 |
| 28135 | 0.003 |
| 28136 | 0.004 |
| 28137 | 0.006 |
| 28138 | 0.009 |
| 28139 | 0.006 |
| 28140 | 0.002 |
| 28141 | 0.003 |
| 28142 | 0.006 |
| 28143 | 0.004 |
| 28144 | 0.003 |
| 28145 | 0.004 |
| 28146 | 0.003 |
| 28147 | 0.002 |
| 28148 | 0.003 |
| 28149 | 0.008 |
| 28150 | 0.007 |
| 28151 | 0.003 |
| 28152 | 0.001 |
| 28153 | 0.003 |
| 28154 | 0.002 |
| 28155 | 0.004 |
| 28156 | 0.002 |
| 28157 | 0.002 |
| 28158 | 0.005 |
| 28159 | 0.005 |
| 28160 | 0.002 |
| 28161 | 0.002 |
| 28162 | 0.004 |
| 28163 | 0.001 |
| 28164 | 0.007 |
| 28165 | 0.005 |
| 28166 | 0.006 |
| 28167 | 0.004 |
| 28168 | 0.002 |
| 28169 | 0.004 |
| 28170 | 0.004 |
| 28171 | 0.001 |
| 28172 | 0.004 |
| 28173 | 0.002 |
| 28174 | 0.003 |
| 28175 | 0.003 |
| 28176 | 0.006 |
| 28177 | 0.007 |
| 28178 | 0.007 |
| 28179 | 0.003 |
| 28180 | 0.005 |
| 28181 | 0.003 |
| 28182 | 0.003 |
| 28183 | 0.002 |
| 28184 | 0.002 |
| 28185 | 0.006 |
| 28186 | 0.001 |
| 28187 | 0.002 |
| 28188 | 0.007 |
| 28189 | 0.007 |
| 28190 | 0.006 |
| 28191 | 0.002 |
| 28192 | 0.002 |
| 28193 | 0.006 |
| 28194 | 0.006 |
| 28195 | 0.004 |
| 28196 | 0.004 |
| 28197 | 0.008 |
| 28198 | 0.001 |
| 28199 | 0.001 |
| 28200 | 0.005 |
| 28201 | 0.001 |
| 28202 | 0.002 |
| 28203 | 0.003 |
| 28204 | 0.006 |
| 28205 | 0.005 |
| 28206 | 0.002 |
| 28207 | 0.002 |
| 28208 | 0.005 |
| 28209 | 0.004 |
| 28210 | 0.002 |
| 28211 | 0.006 |
| 28212 | 0.008 |
| 28213 | 0.006 |
| 28214 | 0.004 |
| 28215 | 0.004 |
| 28216 | 0.006 |
| 28217 | 0.002 |
| 28218 | 0.004 |
| 28219 | 0.002 |
| 28220 | 0.005 |
| 28221 | 0.004 |
| 28222 | 0.001 |
| 28223 | 0.003 |
| 28224 | 0.002 |
| 28225 | 0.006 |
| 28226 | 0.002 |
| 28227 | 0.002 |
| 28228 | 0.003 |
| 28229 | 0.006 |
| 28230 | 0.001 |
| 28231 | 0.002 |
| 28232 | 0.001 |
| 28233 | 0.005 |
| 28234 | 0.002 |
| 28235 | 0.003 |
| 28236 | 0.003 |
| 28237 | 0.004 |
| 28238 | 0.005 |
| 28239 | 0.004 |
| 28240 | 0.003 |
| 28241 | 0.005 |
| 28242 | 0.002 |
| 28243 | 0.004 |
| 28244 | 0.004 |
| 28245 | 0.004 |
| 28246 | 0.005 |
| 28247 | 0.005 |
| 28248 | 0.005 |
| 28249 | 0.001 |
| 28250 | 0.006 |
| 28251 | 0.007 |
| 28252 | 0.009 |
| 28253 | 0.001 |
| 28254 | 0.002 |
| 28255 | 0.007 |
| 28256 | 0.008 |
| 28257 | 0.002 |
| 28258 | 0.001 |
| 28259 | 0.003 |
| 28260 | 0.003 |
| 28261 | 0.002 |
| 28262 | 0.001 |
| 28263 | 0.007 |
| 28264 | 0.003 |
| 28265 | 0.001 |
| 28266 | 0.004 |
| 28267 | 0.003 |
| 28268 | 0.006 |
| 28269 | 0.003 |
| 28270 | 0.002 |
| 28271 | 0.007 |
| 28272 | 0.004 |
| 28273 | 0.005 |
| 28274 | 0.004 |
| 28275 | 0.007 |
| 28276 | 0.007 |
| 28277 | 0.004 |
| 28278 | 0.007 |
| 28279 | 0.011 |
| 28280 | 0.002 |
| 28281 | 0.002 |
| 28282 | 0.002 |
| 28283 | 0.006 |
| 28284 | 0.008 |
| 28285 | 0.002 |
| 28286 | 0.002 |
| 28287 | 0.004 |
| 28288 | 0.008 |
| 28289 | 0.002 |
| 28290 | 0.003 |
| 28291 | 0.007 |
| 28292 | 0.008 |
| 28293 | 0.001 |
| 28294 | 0.003 |
| 28295 | 0.002 |
| 28296 | 0.002 |
| 28297 | 0.003 |
| 28298 | 0.007 |
| 28299 | 0.008 |
| 28300 | 0.007 |
| 28301 | 0.001 |
| 28302 | 0.003 |
| 28303 | 0.01 |
| 28304 | 0.006 |
| 28305 | 0.003 |
| 28306 | 0.003 |
| 28307 | 0.003 |
| 28308 | 0.004 |
| 28309 | 0.002 |
| 28310 | 0.001 |
| 28311 | 0.005 |
| 28312 | 0.008 |
| 28313 | 0.001 |
| 28314 | 0.001 |
| 28315 | 0.005 |
| 28316 | 0.007 |
| 28317 | 0.001 |
| 28318 | 0.002 |
| 28319 | 0.001 |
| 28320 | 0.004 |
| 28321 | 0.006 |
| 28322 | 0.008 |
| 28323 | 0.008 |
| 28324 | 0.004 |
| 28325 | 0.002 |
| 28326 | 0.004 |
| 28327 | 0.004 |
| 28328 | 0.011 |
| 28329 | 0.003 |
| 28330 | 0.004 |
| 28331 | 0.003 |
| 28332 | 0.003 |
| 28333 | 0.004 |
| 28334 | 0.005 |
| 28335 | 0.005 |
| 28336 | 0.002 |
| 28337 | 0.004 |
| 28338 | 0.004 |
| 28339 | 0.005 |
| 28340 | 0.007 |
| 28341 | 0.002 |
| 28342 | 0.002 |
| 28343 | 0.003 |
| 28344 | 0.008 |
| 28345 | 0.006 |
| 28346 | 0.002 |
| 28347 | 0.002 |
| 28348 | 0.004 |
| 28349 | 0.009 |
| 28350 | 0.001 |
| 28351 | 0.003 |
| 28352 | 0.003 |
| 28353 | 0.005 |
| 28354 | 0.002 |
| 28355 | 0.002 |
| 28356 | 0.003 |
| 28357 | 0.005 |
| 28358 | 0.003 |
| 28359 | 0.003 |
| 28360 | 0.005 |
| 28361 | 0.003 |
| 28362 | 0.005 |
| 28363 | 0.003 |
| 28364 | 0.003 |
| 28365 | 0.002 |
| 28366 | 0.001 |
| 28367 | 0.002 |
| 28368 | 0.002 |
| 28369 | 0.002 |
| 28370 | 0.003 |
| 28371 | 0.003 |
| 28372 | 0.005 |
| 28373 | 0.006 |
| 28374 | 0.003 |
| 28375 | 0.002 |
| 28376 | 0.005 |
| 28377 | 0.004 |
| 28378 | 0.003 |
| 28379 | 0.004 |
| 28380 | 0.003 |
| 28381 | 0.005 |
| 28382 | 0.001 |
| 28383 | 0.007 |
| 28384 | 0.011 |
| 28385 | 0.007 |
| 28386 | 0.002 |
| 28387 | 0.005 |
| 28388 | 0.005 |
| 28389 | 0.004 |
| 28390 | 0.003 |
| 28391 | 0.003 |
| 28392 | 0.004 |
| 28393 | 0.001 |
| 28394 | 0.003 |
| 28395 | 0.005 |
| 28396 | 0.001 |
| 28397 | 0.004 |
| 28398 | 0.002 |
| 28399 | 0.001 |
| 28400 | 0.003 |
| 28401 | 0.002 |
| 28402 | 0.004 |
| 28403 | 0.003 |
| 28404 | 0.002 |
| 28405 | 0.001 |
| 28406 | 0.004 |
| 28407 | 0.005 |
| 28408 | 0.009 |
| 28409 | 0.008 |
| 28410 | 0.003 |
| 28411 | 0.002 |
| 28412 | 0.003 |
| 28413 | 0.005 |
| 28414 | 0.003 |
| 28415 | 0.002 |
| 28416 | 0.003 |
| 28417 | 0.009 |
| 28418 | 0.013 |
| 28419 | 0.004 |
| 28420 | 0.006 |
| 28421 | 0.002 |
| 28422 | 0.006 |
| 28423 | 0.003 |
| 28424 | 0.005 |
| 28425 | 0.009 |
| 28426 | 0.003 |
| 28427 | 0.004 |
| 28428 | 0.002 |
| 28429 | 0.004 |
| 28430 | 0.002 |
| 28431 | 0.003 |
| 28432 | 0.002 |
| 28433 | 0.003 |
| 28434 | 0.005 |
| 28435 | 0.009 |
| 28436 | 0.003 |
| 28437 | 0.005 |
| 28438 | 0.009 |
| 28439 | 0.01 |
| 28440 | 0.004 |
| 28441 | 0.007 |
| 28442 | 0.004 |
| 28443 | 0.012 |
| 28444 | 0.011 |
| 28445 | 0.005 |
| 28446 | 0.005 |
| 28447 | 0.003 |
| 28448 | 0.002 |
| 28449 | 0.004 |
| 28450 | 0.008 |
| 28451 | 0.008 |
| 28452 | 0.004 |
| 28453 | 0.006 |
| 28454 | 0.009 |
| 28455 | 0.004 |
| 28456 | 0.006 |
| 28457 | 0.004 |
| 28458 | 0.008 |
| 28459 | 0.012 |
| 28460 | 0.012 |
| 28461 | 0.005 |
| 28462 | 0.003 |
| 28463 | 0.004 |
| 28464 | 0.004 |
| 28465 | 0.003 |
| 28466 | 0.006 |
| 28467 | 0.004 |
| 28468 | 0.004 |
| 28469 | 0.005 |
| 28470 | 0.012 |
| 28471 | 0.006 |
| 28472 | 0.002 |
| 28473 | 0.002 |
| 28474 | 0.003 |
| 28475 | 0.002 |
| 28476 | 0.008 |
| 28477 | 0.004 |
| 28478 | 0.002 |
| 28479 | 0.002 |
| 28480 | 0.006 |
| 28481 | 0.008 |
| 28482 | 0.004 |
| 28483 | 0.005 |
| 28484 | 0.005 |
| 28485 | 0.002 |
| 28486 | 0.002 |
| 28487 | 0.002 |
| 28488 | 0.006 |
| 28489 | 0.005 |
| 28490 | 0.002 |
| 28491 | 0.003 |
| 28492 | 0.002 |
| 28493 | 0.008 |
| 28494 | 0.003 |
| 28495 | 0.001 |
| 28496 | 0.007 |
| 28497 | 0.009 |
| 28498 | 0.003 |
| 28499 | 0.003 |
| 28500 | 0.002 |
| 28501 | 0.006 |
| 28502 | 0.002 |
| 28503 | 0.002 |
| 28504 | 0.004 |
| 28505 | 0.006 |
| 28506 | 0.006 |
| 28507 | 0.004 |
| 28508 | 0.006 |
| 28509 | 0.002 |
| 28510 | 0.002 |
| 28511 | 0.003 |
| 28512 | 0.007 |
| 28513 | 0.006 |
| 28514 | 0.002 |
| 28515 | 0.003 |
| 28516 | 0.008 |
| 28517 | 0.007 |
| 28518 | 0.004 |
| 28519 | 0.001 |
| 28520 | 0.005 |
| 28521 | 0.004 |
| 28522 | 0.002 |
| 28523 | 0.003 |
| 28524 | 0.005 |
| 28525 | 0.003 |
| 28526 | 0.002 |
| 28527 | 0.002 |
| 28528 | 0.005 |
| 28529 | 0.002 |
| 28530 | 0.002 |
| 28531 | 0.004 |
| 28532 | 0.007 |
| 28533 | 0.007 |
| 28534 | 0.006 |
| 28535 | 0.007 |
| 28536 | 0.007 |
| 28537 | 0.003 |
| 28538 | 0.004 |
| 28539 | 0.006 |
| 28540 | 0.007 |
| 28541 | 0.004 |
| 28542 | 0.003 |
| 28543 | 0.002 |
| 28544 | 0.003 |
| 28545 | 0.003 |
| 28546 | 0.008 |
| 28547 | 0.006 |
| 28548 | 0.004 |
| 28549 | 0.003 |
| 28550 | 0.001 |
| 28551 | 0.003 |
| 28552 | 0.007 |
| 28553 | 0.003 |
| 28554 | 0.003 |
| 28555 | 0.007 |
| 28556 | 0.007 |
| 28557 | 0.003 |
| 28558 | 0.003 |
| 28559 | 0.005 |
| 28560 | 0.005 |
| 28561 | 0.005 |
| 28562 | 0.004 |
| 28563 | 0.006 |
| 28564 | 0.006 |
| 28565 | 0.002 |
| 28566 | 0.006 |
| 28567 | 0.004 |
| 28568 | 0.005 |
| 28569 | 0.002 |
| 28570 | 0.003 |
| 28571 | 0.003 |
| 28572 | 0.009 |
| 28573 | 0.003 |
| 28574 | 0.004 |
| 28575 | 0.006 |
| 28576 | 0.005 |
| 28577 | 0.003 |
| 28578 | 0.002 |
| 28579 | 0.005 |
| 28580 | 0.006 |
| 28581 | 0.009 |
| 28582 | 0.007 |
| 28583 | 0.002 |
| 28584 | 0.002 |
| 28585 | 0.003 |
| 28586 | 0.003 |
| 28587 | 0.003 |
| 28588 | 0.003 |
| 28589 | 0.002 |
| 28590 | 0.004 |
| 28591 | 0.005 |
| 28592 | 0.006 |
| 28593 | 0.003 |
| 28594 | 0.004 |
| 28595 | 0.005 |
| 28596 | 0.008 |
| 28597 | 0.001 |
| 28598 | 0.001 |
| 28599 | 0.005 |
| 28600 | 0.005 |
| 28601 | 0.003 |
| 28602 | 0.003 |
| 28603 | 0.002 |
| 28604 | 0.006 |
| 28605 | 0.002 |
| 28606 | 0.006 |
| 28607 | 0.009 |
| 28608 | 0.01 |
| 28609 | 0.004 |
| 28610 | 0.004 |
| 28611 | 0.005 |
| 28612 | 0.009 |
| 28613 | 0.004 |
| 28614 | 0.005 |
| 28615 | 0.003 |
| 28616 | 0.006 |
| 28617 | 0.006 |
| 28618 | 0.005 |
| 28619 | 0.008 |
| 28620 | 0.007 |
| 28621 | 0.002 |
| 28622 | 0.004 |
| 28623 | 0.006 |
| 28624 | 0.005 |
| 28625 | 0.003 |
| 28626 | 0.001 |
| 28627 | 0.004 |
| 28628 | 0.005 |
| 28629 | 0.001 |
| 28630 | 0.002 |
| 28631 | 0.009 |
| 28632 | 0.005 |
| 28633 | 0.003 |
| 28634 | 0.002 |
| 28635 | 0.003 |
| 28636 | 0.004 |
| 28637 | 0.005 |
| 28638 | 0.004 |
| 28639 | 0.009 |
| 28640 | 0.01 |
| 28641 | 0.005 |
| 28642 | 0.003 |
| 28643 | 0.003 |
| 28644 | 0.003 |
| 28645 | 0.001 |
| 28646 | 0.003 |
| 28647 | 0.003 |
| 28648 | 0.006 |
| 28649 | 0.004 |
| 28650 | 0.002 |
| 28651 | 0.007 |
| 28652 | 0.002 |
| 28653 | 0.003 |
| 28654 | 0.003 |
| 28655 | 0.003 |
| 28656 | 0.002 |
| 28657 | 0.003 |
| 28658 | 0.004 |
| 28659 | 0.005 |
| 28660 | 0.001 |
| 28661 | 0.003 |
| 28662 | 0.004 |
| 28663 | 0.002 |
| 28664 | 0.008 |
| 28665 | 0.001 |
| 28666 | 0.01 |
| 28667 | 0.008 |
| 28668 | 0.003 |
| 28669 | 0.003 |
| 28670 | 0.002 |
| 28671 | 0.003 |
| 28672 | 0.005 |
| 28673 | 0.002 |
| 28674 | 0.002 |
| 28675 | 0.007 |
| 28676 | 0.004 |
| 28677 | 0.002 |
| 28678 | 0.003 |
| 28679 | 0.011 |
| 28680 | 0.004 |
| 28681 | 0.004 |
| 28682 | 0.004 |
| 28683 | 0.006 |
| 28684 | 0.015 |
| 28685 | 0.014 |
| 28686 | 0.005 |
| 28687 | 0.002 |
| 28688 | 0.005 |
| 28689 | 0.004 |
| 28690 | 0.003 |
| 28691 | 0.002 |
| 28692 | 0.001 |
| 28693 | 0.002 |
| 28694 | 0.002 |
| 28695 | 0.001 |
| 28696 | 0.004 |
| 28697 | 0.003 |
| 28698 | 0.002 |
| 28699 | 0.002 |
| 28700 | 0.002 |
| 28701 | 0.009 |
| 28702 | 0.003 |
| 28703 | 0.003 |
| 28704 | 0.001 |
| 28705 | 0.006 |
| 28706 | 0.002 |
| 28707 | 0.005 |
| 28708 | 0.002 |
| 28709 | 0.002 |
| 28710 | 0.007 |
| 28711 | 0.002 |
| 28712 | 0.005 |
| 28713 | 0.006 |
| 28714 | 0.009 |
| 28715 | 0.006 |
| 28716 | 0.004 |
| 28717 | 0.008 |
| 28718 | 0.001 |
| 28719 | 0.003 |
| 28720 | 0.003 |
| 28721 | 0.005 |
| 28722 | 0.004 |
| 28723 | 0.007 |
| 28724 | 0.006 |
| 28725 | 0.005 |
| 28726 | 0.006 |
| 28727 | 0.005 |
| 28728 | 0.003 |
| 28729 | 0.005 |
| 28730 | 0.001 |
| 28731 | 0.004 |
| 28732 | 0.006 |
| 28733 | 0.003 |
| 28734 | 0.005 |
| 28735 | 0.001 |
| 28736 | 0.001 |
| 28737 | 0.002 |
| 28738 | 0.004 |
| 28739 | 0.01 |
| 28740 | 0.003 |
| 28741 | 0.006 |
| 28742 | 0.002 |
| 28743 | 0.004 |
| 28744 | 0.004 |
| 28745 | 0.008 |
| 28746 | 0.003 |
| 28747 | 0.004 |
| 28748 | 0.003 |
| 28749 | 0.005 |
| 28750 | 0.004 |
| 28751 | 0.002 |
| 28752 | 0.003 |
| 28753 | 0.007 |
| 28754 | 0.008 |
| 28755 | 0.006 |
| 28756 | 0.009 |
| 28757 | 0.005 |
| 28758 | 0.005 |
| 28759 | 0.003 |
| 28760 | 0.008 |
| 28761 | 0.003 |
| 28762 | 0.005 |
| 28763 | 0.005 |
| 28764 | 0.004 |
| 28765 | 0.006 |
| 28766 | 0.005 |
| 28767 | 0.005 |
| 28768 | 0.002 |
| 28769 | 0.003 |
| 28770 | 0.004 |
| 28771 | 0.005 |
| 28772 | 0.007 |
| 28773 | 0.003 |
| 28774 | 0.002 |
| 28775 | 0.004 |
| 28776 | 0.006 |
| 28777 | 0.002 |
| 28778 | 0.006 |
| 28779 | 0.004 |
| 28780 | 0.004 |
| 28781 | 0.005 |
| 28782 | 0.004 |
| 28783 | 0.002 |
| 28784 | 0.002 |
| 28785 | 0.007 |
| 28786 | 0.001 |
| 28787 | 0.002 |
| 28788 | 0.007 |
| 28789 | 0.008 |
| 28790 | 0.004 |
| 28791 | 0.004 |
| 28792 | 0.003 |
| 28793 | 0.003 |
| 28794 | 0.004 |
| 28795 | 0.006 |
| 28796 | 0.007 |
| 28797 | 0.008 |
| 28798 | 0.002 |
| 28799 | 0.001 |
| 28800 | 0.002 |
| 28801 | 0.002 |
| 28802 | 0.003 |
| 28803 | 0.003 |
| 28804 | 0.003 |
| 28805 | 0.005 |
| 28806 | 0.002 |
| 28807 | 0.003 |
| 28808 | 0.005 |
| 28809 | 0.002 |
| 28810 | 0.003 |
| 28811 | 0.003 |
| 28812 | 0.004 |
| 28813 | 0.008 |
| 28814 | 0.003 |
| 28815 | 0.002 |
| 28816 | 0.006 |
| 28817 | 0.005 |
| 28818 | 0.002 |
| 28819 | 0.004 |
| 28820 | 0.003 |
| 28821 | 0.002 |
| 28822 | 0.002 |
| 28823 | 0.011 |
| 28824 | 0.009 |
| 28825 | 0.003 |
| 28826 | 0.004 |
| 28827 | 0.005 |
| 28828 | 0.001 |
| 28829 | 0.006 |
| 28830 | 0.004 |
| 28831 | 0.008 |
| 28832 | 0.007 |
| 28833 | 0.004 |
| 28834 | 0.002 |
| 28835 | 0.003 |
| 28836 | 0.006 |
| 28837 | 0.002 |
| 28838 | 0.002 |
| 28839 | 0.002 |
| 28840 | 0.003 |
| 28841 | 0.003 |
| 28842 | 0 |
| 28843 | 0.009 |
| 28844 | 0.002 |
| 28845 | 0.007 |
| 28846 | 0.004 |
| 28847 | 0.006 |
| 28848 | 0.008 |
| 28849 | 0.005 |
| 28850 | 0.004 |
| 28851 | 0.006 |
| 28852 | 0.005 |
| 28853 | 0.002 |
| 28854 | 0.005 |
| 28855 | 0.011 |
| 28856 | 0.008 |
| 28857 | 0.002 |
| 28858 | 0.001 |
| 28859 | 0.007 |
| 28860 | 0.007 |
| 28861 | 0.004 |
| 28862 | 0.003 |
| 28863 | 0.006 |
| 28864 | 0.002 |
| 28865 | 0.002 |
| 28866 | 0.003 |
| 28867 | 0.005 |
| 28868 | 0.002 |
| 28869 | 0.003 |
| 28870 | 0.006 |
| 28871 | 0.009 |
| 28872 | 0.005 |
| 28873 | 0.005 |
| 28874 | 0.005 |
| 28875 | 0.01 |
| 28876 | 0.007 |
| 28877 | 0.003 |
| 28878 | 0.002 |
| 28879 | 0.003 |
| 28880 | 0.005 |
| 28881 | 0.002 |
| 28882 | 0.004 |
| 28883 | 0.007 |
| 28884 | 0.007 |
| 28885 | 0.002 |
| 28886 | 0.002 |
| 28887 | 0.006 |
| 28888 | 0.002 |
| 28889 | 0.002 |
| 28890 | 0.003 |
| 28891 | 0.002 |
| 28892 | 0.003 |
| 28893 | 0.003 |
| 28894 | 0.003 |
| 28895 | 0.004 |
| 28896 | 0.002 |
| 28897 | 0.001 |
| 28898 | 0.002 |
| 28899 | 0.004 |
| 28900 | 0.009 |
| 28901 | 0.001 |
| 28902 | 0.004 |
| 28903 | 0.006 |
| 28904 | 0.004 |
| 28905 | 0.007 |
| 28906 | 0.002 |
| 28907 | 0.003 |
| 28908 | 0.005 |
| 28909 | 0.002 |
| 28910 | 0.002 |
| 28911 | 0.003 |
| 28912 | 0.009 |
| 28913 | 0.006 |
| 28914 | 0.003 |
| 28915 | 0.002 |
| 28916 | 0.002 |
| 28917 | 0.003 |
| 28918 | 0.002 |
| 28919 | 0.005 |
| 28920 | 0.01 |
| 28921 | 0.011 |
| 28922 | 0.004 |
| 28923 | 0.005 |
| 28924 | 0.006 |
| 28925 | 0.002 |
| 28926 | 0.003 |
| 28927 | 0.004 |
| 28928 | 0.008 |
| 28929 | 0.009 |
| 28930 | 0.002 |
| 28931 | 0.004 |
| 28932 | 0.01 |
| 28933 | 0.004 |
| 28934 | 0.005 |
| 28935 | 0.008 |
| 28936 | 0.005 |
| 28937 | 0.007 |
| 28938 | 0.001 |
| 28939 | 0.002 |
| 28940 | 0.005 |
| 28941 | 0.006 |
| 28942 | 0.001 |
| 28943 | 0.005 |
| 28944 | 0.002 |
| 28945 | 0.003 |
| 28946 | 0.004 |
| 28947 | 0.007 |
| 28948 | 0.006 |
| 28949 | 0.006 |
| 28950 | 0.002 |
| 28951 | 0.008 |
| 28952 | 0.005 |
| 28953 | 0.002 |
| 28954 | 0.002 |
| 28955 | 0.001 |
| 28956 | 0.005 |
| 28957 | 0.007 |
| 28958 | 0.004 |
| 28959 | 0.003 |
| 28960 | 0.003 |
| 28961 | 0.005 |
| 28962 | 0.005 |
| 28963 | 0.004 |
| 28964 | 0.005 |
| 28965 | 0.003 |
| 28966 | 0.004 |
| 28967 | 0.002 |
| 28968 | 0.006 |
| 28969 | 0.002 |
| 28970 | 0.002 |
| 28971 | 0.003 |
| 28972 | 0.005 |
| 28973 | 0.003 |
| 28974 | 0.002 |
| 28975 | 0.003 |
| 28976 | 0.002 |
| 28977 | 0.003 |
| 28978 | 0.002 |
| 28979 | 0.007 |
| 28980 | 0.004 |
| 28981 | 0.004 |
| 28982 | 0.002 |
| 28983 | 0.003 |
| 28984 | 0.003 |
| 28985 | 0.006 |
| 28986 | 0.007 |
| 28987 | 0.004 |
| 28988 | 0.002 |
| 28989 | 0.003 |
| 28990 | 0.011 |
| 28991 | 0.003 |
| 28992 | 0.006 |
| 28993 | 0.005 |
| 28994 | 0.004 |
| 28995 | 0.006 |
| 28996 | 0.006 |
| 28997 | 0.007 |
| 28998 | 0.005 |
| 28999 | 0.005 |
| 29000 | 0.008 |
| 29001 | 0.008 |
| 29002 | 0.002 |
| 29003 | 0.002 |
| 29004 | 0.006 |
| 29005 | 0.004 |
| 29006 | 0.003 |
| 29007 | 0.002 |
| 29008 | 0.003 |
| 29009 | 0.002 |
| 29010 | 0.003 |
| 29011 | 0.003 |
| 29012 | 0.002 |
| 29013 | 0.006 |
| 29014 | 0.003 |
| 29015 | 0.006 |
| 29016 | 0.003 |
| 29017 | 0.003 |
| 29018 | 0.003 |
| 29019 | 0.002 |
| 29020 | 0.003 |
| 29021 | 0.003 |
| 29022 | 0.005 |
| 29023 | 0.004 |
| 29024 | 0.002 |
| 29025 | 0.005 |
| 29026 | 0.003 |
| 29027 | 0.009 |
| 29028 | 0.007 |
| 29029 | 0.006 |
| 29030 | 0.004 |
| 29031 | 0.005 |
| 29032 | 0.006 |
| 29033 | 0.007 |
| 29034 | 0.002 |
| 29035 | 0.004 |
| 29036 | 0.002 |
| 29037 | 0.001 |
| 29038 | 0.003 |
| 29039 | 0.001 |
| 29040 | 0.005 |
| 29041 | 0.003 |
| 29042 | 0.006 |
| 29043 | 0.008 |
| 29044 | 0.009 |
| 29045 | 0.004 |
| 29046 | 0.004 |
| 29047 | 0.004 |
| 29048 | 0.002 |
| 29049 | 0.002 |
| 29050 | 0.003 |
| 29051 | 0.013 |
| 29052 | 0.001 |
| 29053 | 0.001 |
| 29054 | 0.003 |
| 29055 | 0.006 |
| 29056 | 0.005 |
| 29057 | 0.006 |
| 29058 | 0.006 |
| 29059 | 0.004 |
| 29060 | 0.004 |
| 29061 | 0.005 |
| 29062 | 0.001 |
| 29063 | 0.008 |
| 29064 | 0.005 |
| 29065 | 0.007 |
| 29066 | 0.006 |
| 29067 | 0.002 |
| 29068 | 0.003 |
| 29069 | 0.003 |
| 29070 | 0.002 |
| 29071 | 0.008 |
| 29072 | 0.004 |
| 29073 | 0.002 |
| 29074 | 0.002 |
| 29075 | 0.009 |
| 29076 | 0.015 |
| 29077 | 0.01 |
| 29078 | 0.001 |
| 29079 | 0 |
| 29080 | 0.005 |
| 29081 | 0.005 |
| 29082 | 0.008 |
| 29083 | 0.003 |
| 29084 | 0.005 |
| 29085 | 0.005 |
| 29086 | 0.008 |
| 29087 | 0.006 |
| 29088 | 0.005 |
| 29089 | 0.004 |
| 29090 | 0.003 |
| 29091 | 0.005 |
| 29092 | 0.003 |
| 29093 | 0.007 |
| 29094 | 0.006 |
| 29095 | 0.005 |
| 29096 | 0.002 |
| 29097 | 0.003 |
| 29098 | 0.002 |
| 29099 | 0.005 |
| 29100 | 0.002 |
| 29101 | 0.005 |
| 29102 | 0.002 |
| 29103 | 0.003 |
| 29104 | 0.002 |
| 29105 | 0.004 |
| 29106 | 0.001 |
| 29107 | 0.005 |
| 29108 | 0.006 |
| 29109 | 0.002 |
| 29110 | 0.003 |
| 29111 | 0.005 |
| 29112 | 0.007 |
| 29113 | 0.003 |
| 29114 | 0.001 |
| 29115 | 0.002 |
| 29116 | 0.003 |
| 29117 | 0.004 |
| 29118 | 0.002 |
| 29119 | 0.003 |
| 29120 | 0.007 |
| 29121 | 0.002 |
| 29122 | 0.006 |
| 29123 | 0.006 |
| 29124 | 0.008 |
| 29125 | 0.004 |
| 29126 | 0.005 |
| 29127 | 0.004 |
| 29128 | 0.001 |
| 29129 | 0.003 |
| 29130 | 0.002 |
| 29131 | 0.006 |
| 29132 | 0.003 |
| 29133 | 0.007 |
| 29134 | 0.004 |
| 29135 | 0.005 |
| 29136 | 0.008 |
| 29137 | 0.003 |
| 29138 | 0.003 |
| 29139 | 0.004 |
| 29140 | 0.006 |
| 29141 | 0.003 |
| 29142 | 0.005 |
| 29143 | 0.003 |
| 29144 | 0.006 |
| 29145 | 0.003 |
| 29146 | 0.004 |
| 29147 | 0.005 |
| 29148 | 0 |
| 29149 | 0.003 |
| 29150 | 0.006 |
| 29151 | 0.006 |
| 29152 | 0.005 |
| 29153 | 0.002 |
| 29154 | 0.002 |
| 29155 | 0.007 |
| 29156 | 0.003 |
| 29157 | 0.003 |
| 29158 | 0.001 |
| 29159 | 0.002 |
| 29160 | 0.003 |
| 29161 | 0.002 |
| 29162 | 0.009 |
| 29163 | 0.002 |
| 29164 | 0.005 |
| 29165 | 0.003 |
| 29166 | 0.004 |
| 29167 | 0.006 |
| 29168 | 0.008 |
| 29169 | 0.001 |
| 29170 | 0.002 |
| 29171 | 0.002 |
| 29172 | 0.004 |
| 29173 | 0.004 |
| 29174 | 0.003 |
| 29175 | 0.003 |
| 29176 | 0.006 |
| 29177 | 0.003 |
| 29178 | 0.005 |
| 29179 | 0.005 |
| 29180 | 0.006 |
| 29181 | 0.001 |
| 29182 | 0.003 |
| 29183 | 0.012 |
| 29184 | 0.006 |
| 29185 | 0.004 |
| 29186 | 0.004 |
| 29187 | 0.001 |
| 29188 | 0.003 |
| 29189 | 0.002 |
| 29190 | 0.006 |
| 29191 | 0.008 |
| 29192 | 0.001 |
| 29193 | 0.008 |
| 29194 | 0.008 |
| 29195 | 0.004 |
| 29196 | 0.001 |
| 29197 | 0.005 |
| 29198 | 0.003 |
| 29199 | 0.001 |
| 29200 | 0.004 |
| 29201 | 0.003 |
| 29202 | 0.003 |
| 29203 | 0.002 |
| 29204 | 0.007 |
| 29205 | 0.004 |
| 29206 | 0.002 |
| 29207 | 0.004 |
| 29208 | 0.008 |
| 29209 | 0.003 |
| 29210 | 0.003 |
| 29211 | 0.001 |
| 29212 | 0.003 |
| 29213 | 0.006 |
| 29214 | 0.003 |
| 29215 | 0.007 |
| 29216 | 0.004 |
| 29217 | 0.002 |
| 29218 | 0.003 |
| 29219 | 0.002 |
| 29220 | 0.003 |
| 29221 | 0.001 |
| 29222 | 0.003 |
| 29223 | 0.002 |
| 29224 | 0.008 |
| 29225 | 0.01 |
| 29226 | 0.001 |
| 29227 | 0.001 |
| 29228 | 0.004 |
| 29229 | 0.007 |
| 29230 | 0.001 |
| 29231 | 0.004 |
| 29232 | 0.004 |
| 29233 | 0.005 |
| 29234 | 0.003 |
| 29235 | 0.001 |
| 29236 | 0.005 |
| 29237 | 0.006 |
| 29238 | 0.004 |
| 29239 | 0.003 |
| 29240 | 0.005 |
| 29241 | 0.004 |
| 29242 | 0.003 |
| 29243 | 0.004 |
| 29244 | 0.005 |
| 29245 | 0.007 |
| 29246 | 0.003 |
| 29247 | 0.001 |
| 29248 | 0.009 |
| 29249 | 0.005 |
| 29250 | 0.001 |
| 29251 | 0.001 |
| 29252 | 0.001 |
| 29253 | 0.003 |
| 29254 | 0.005 |
| 29255 | 0.003 |
| 29256 | 0.002 |
| 29257 | 0.003 |
| 29258 | 0.002 |
| 29259 | 0.003 |
| 29260 | 0.004 |
| 29261 | 0.004 |
| 29262 | 0.004 |
| 29263 | 0.003 |
| 29264 | 0.008 |
| 29265 | 0.009 |
| 29266 | 0.004 |
| 29267 | 0.003 |
| 29268 | 0.003 |
| 29269 | 0.008 |
| 29270 | 0.003 |
| 29271 | 0.002 |
| 29272 | 0.008 |
| 29273 | 0.007 |
| 29274 | 0.001 |
| 29275 | 0.002 |
| 29276 | 0.003 |
| 29277 | 0.008 |
| 29278 | 0.003 |
| 29279 | 0.005 |
| 29280 | 0.006 |
| 29281 | 0.007 |
| 29282 | 0.002 |
| 29283 | 0.005 |
| 29284 | 0.002 |
| 29285 | 0.003 |
| 29286 | 0.002 |
| 29287 | 0.005 |
| 29288 | 0.004 |
| 29289 | 0.005 |
| 29290 | 0.003 |
| 29291 | 0.006 |
| 29292 | 0.005 |
| 29293 | 0.005 |
| 29294 | 0.003 |
| 29295 | 0.003 |
| 29296 | 0.003 |
| 29297 | 0.006 |
| 29298 | 0.006 |
| 29299 | 0.004 |
| 29300 | 0.003 |
| 29301 | 0.009 |
| 29302 | 0.001 |
| 29303 | 0.002 |
| 29304 | 0.008 |
| 29305 | 0.006 |
| 29306 | 0.002 |
| 29307 | 0.004 |
| 29308 | 0.005 |
| 29309 | 0.003 |
| 29310 | 0.001 |
| 29311 | 0.005 |
| 29312 | 0.007 |
| 29313 | 0.007 |
| 29314 | 0.002 |
| 29315 | 0.005 |
| 29316 | 0.004 |
| 29317 | 0.007 |
| 29318 | 0.002 |
| 29319 | 0.004 |
| 29320 | 0.004 |
| 29321 | 0.008 |
| 29322 | 0.001 |
| 29323 | 0.003 |
| 29324 | 0.003 |
| 29325 | 0.002 |
| 29326 | 0.005 |
| 29327 | 0.001 |
| 29328 | 0.002 |
| 29329 | 0.002 |
| 29330 | 0.003 |
| 29331 | 0.002 |
| 29332 | 0.006 |
| 29333 | 0.002 |
| 29334 | 0.005 |
| 29335 | 0.009 |
| 29336 | 0.002 |
| 29337 | 0.003 |
| 29338 | 0.002 |
| 29339 | 0.002 |
| 29340 | 0.006 |
| 29341 | 0.006 |
| 29342 | 0.002 |
| 29343 | 0.007 |
| 29344 | 0.002 |
| 29345 | 0.005 |
| 29346 | 0.006 |
| 29347 | 0.007 |
| 29348 | 0.014 |
| 29349 | 0.004 |
| 29350 | 0.007 |
| 29351 | 0.002 |
| 29352 | 0.005 |
| 29353 | 0.006 |
| 29354 | 0.002 |
| 29355 | 0.001 |
| 29356 | 0.002 |
| 29357 | 0.008 |
| 29358 | 0.002 |
| 29359 | 0.004 |
| 29360 | 0.007 |
| 29361 | 0.005 |
| 29362 | 0.009 |
| 29363 | 0.005 |
| 29364 | 0.002 |
| 29365 | 0.003 |
| 29366 | 0.01 |
| 29367 | 0.007 |
| 29368 | 0.005 |
| 29369 | 0.007 |
| 29370 | 0.004 |
| 29371 | 0.006 |
| 29372 | 0.004 |
| 29373 | 0.003 |
| 29374 | 0.007 |
| 29375 | 0.005 |
| 29376 | 0.005 |
| 29377 | 0.003 |
| 29378 | 0.006 |
| 29379 | 0.002 |
| 29380 | 0.007 |
| 29381 | 0.004 |
| 29382 | 0.006 |
| 29383 | 0.008 |
| 29384 | 0.005 |
| 29385 | 0.002 |
| 29386 | 0.005 |
| 29387 | 0.006 |
| 29388 | 0.003 |
| 29389 | 0.009 |
| 29390 | 0.005 |
| 29391 | 0.003 |
| 29392 | 0.003 |
| 29393 | 0.004 |
| 29394 | 0.007 |
| 29395 | 0.011 |
| 29396 | 0.008 |
| 29397 | 0.007 |
| 29398 | 0.003 |
| 29399 | 0.006 |
| 29400 | 0.004 |
| 29401 | 0.006 |
| 29402 | 0.002 |
| 29403 | 0.003 |
| 29404 | 0.005 |
| 29405 | 0.003 |
| 29406 | 0.002 |
| 29407 | 0.003 |
| 29408 | 0.004 |
| 29409 | 0.002 |
| 29410 | 0.001 |
| 29411 | 0.005 |
| 29412 | 0.003 |
| 29413 | 0.001 |
| 29414 | 0.003 |
| 29415 | 0.007 |
| 29416 | 0.003 |
| 29417 | 0.004 |
| 29418 | 0.01 |
| 29419 | 0.008 |
| 29420 | 0.007 |
| 29421 | 0.002 |
| 29422 | 0.003 |
| 29423 | 0.004 |
| 29424 | 0.003 |
| 29425 | 0.002 |
| 29426 | 0.002 |
| 29427 | 0.004 |
| 29428 | 0.003 |
| 29429 | 0.002 |
| 29430 | 0.004 |
| 29431 | 0.01 |
| 29432 | 0.012 |
| 29433 | 0.002 |
| 29434 | 0.004 |
| 29435 | 0.004 |
| 29436 | 0.008 |
| 29437 | 0.002 |
| 29438 | 0.004 |
| 29439 | 0.006 |
| 29440 | 0.003 |
| 29441 | 0.002 |
| 29442 | 0.005 |
| 29443 | 0.008 |
| 29444 | 0.005 |
| 29445 | 0.002 |
| 29446 | 0.002 |
| 29447 | 0.003 |
| 29448 | 0.001 |
| 29449 | 0.004 |
| 29450 | 0.006 |
| 29451 | 0.008 |
| 29452 | 0.01 |
| 29453 | 0.003 |
| 29454 | 0.004 |
| 29455 | 0.003 |
| 29456 | 0.004 |
| 29457 | 0.002 |
| 29458 | 0.003 |
| 29459 | 0.012 |
| 29460 | 0.003 |
| 29461 | 0.003 |
| 29462 | 0.003 |
| 29463 | 0.006 |
| 29464 | 0.007 |
| 29465 | 0.002 |
| 29466 | 0.003 |
| 29467 | 0.004 |
| 29468 | 0.01 |
| 29469 | 0.002 |
| 29470 | 0.003 |
| 29471 | 0.002 |
| 29472 | 0.006 |
| 29473 | 0.003 |
| 29474 | 0.002 |
| 29475 | 0.007 |
| 29476 | 0.002 |
| 29477 | 0.001 |
| 29478 | 0.002 |
| 29479 | 0.002 |
| 29480 | 0.004 |
| 29481 | 0.006 |
| 29482 | 0.003 |
| 29483 | 0.002 |
| 29484 | 0.005 |
| 29485 | 0.006 |
| 29486 | 0.003 |
| 29487 | 0.004 |
| 29488 | 0.003 |
| 29489 | 0.004 |
| 29490 | 0.001 |
| 29491 | 0.002 |
| 29492 | 0.003 |
| 29493 | 0.008 |
| 29494 | 0.003 |
| 29495 | 0.002 |
| 29496 | 0.004 |
| 29497 | 0.008 |
| 29498 | 0.003 |
| 29499 | 0.004 |
| 29500 | 0.006 |
| 29501 | 0.003 |
| 29502 | 0.001 |
| 29503 | 0.002 |
| 29504 | 0.008 |
| 29505 | 0.004 |
| 29506 | 0.004 |
| 29507 | 0.004 |
| 29508 | 0.003 |
| 29509 | 0.004 |
| 29510 | 0.001 |
| 29511 | 0.001 |
| 29512 | 0.004 |
| 29513 | 0.004 |
| 29514 | 0.003 |
| 29515 | 0.003 |
| 29516 | 0.003 |
| 29517 | 0.007 |
| 29518 | 0.005 |
| 29519 | 0.003 |
| 29520 | 0.008 |
| 29521 | 0.01 |
| 29522 | 0.001 |
| 29523 | 0.002 |
| 29524 | 0.006 |
| 29525 | 0.002 |
| 29526 | 0.004 |
| 29527 | 0 |
| 29528 | 0.002 |
| 29529 | 0.003 |
| 29530 | 0.002 |
| 29531 | 0.008 |
| 29532 | 0.002 |
| 29533 | 0.007 |
| 29534 | 0.005 |
| 29535 | 0.004 |
| 29536 | 0.005 |
| 29537 | 0 |
| 29538 | 0.002 |
| 29539 | 0.002 |
| 29540 | 0.005 |
| 29541 | 0.002 |
| 29542 | 0.002 |
| 29543 | 0.008 |
| 29544 | 0.012 |
| 29545 | 0.005 |
| 29546 | 0.004 |
| 29547 | 0.002 |
| 29548 | 0.005 |
| 29549 | 0.002 |
| 29550 | 0.005 |
| 29551 | 0.004 |
| 29552 | 0.01 |
| 29553 | 0.002 |
| 29554 | 0.001 |
| 29555 | 0.005 |
| 29556 | 0.005 |
| 29557 | 0.004 |
| 29558 | 0.002 |
| 29559 | 0.005 |
| 29560 | 0 |
| 29561 | 0.002 |
| 29562 | 0.005 |
| 29563 | 0.005 |
| 29564 | 0.003 |
| 29565 | 0.002 |
| 29566 | 0.002 |
| 29567 | 0.004 |
| 29568 | 0.008 |
| 29569 | 0.004 |
| 29570 | 0.002 |
| 29571 | 0.006 |
| 29572 | 0.005 |
| 29573 | 0.001 |
| 29574 | 0.004 |
| 29575 | 0.005 |
| 29576 | 0.006 |
| 29577 | 0.001 |
| 29578 | 0.001 |
| 29579 | 0.004 |
| 29580 | 0.004 |
| 29581 | 0.005 |
| 29582 | 0.003 |
| 29583 | 0.003 |
| 29584 | 0.009 |
| 29585 | 0.005 |
| 29586 | 0.003 |
| 29587 | 0.007 |
| 29588 | 0.009 |
| 29589 | 0.001 |
| 29590 | 0.004 |
| 29591 | 0.005 |
| 29592 | 0.003 |
| 29593 | 0.008 |
| 29594 | 0.006 |
| 29595 | 0.002 |
| 29596 | 0.004 |
| 29597 | 0.005 |
| 29598 | 0.003 |
| 29599 | 0.002 |
| 29600 | 0.004 |
| 29601 | 0.003 |
| 29602 | 0.002 |
| 29603 | 0.003 |
| 29604 | 0.004 |
| 29605 | 0.005 |
| 29606 | 0.001 |
| 29607 | 0.003 |
| 29608 | 0.009 |
| 29609 | 0.01 |
| 29610 | 0 |
| 29611 | 0.003 |
| 29612 | 0.005 |
| 29613 | 0.006 |
| 29614 | 0.003 |
| 29615 | 0.004 |
| 29616 | 0.006 |
| 29617 | 0.005 |
| 29618 | 0.002 |
| 29619 | 0.008 |
| 29620 | 0.008 |
| 29621 | 0.005 |
| 29622 | 0.003 |
| 29623 | 0.003 |
| 29624 | 0.011 |
| 29625 | 0.005 |
| 29626 | 0.002 |
| 29627 | 0.001 |
| 29628 | 0.002 |
| 29629 | 0.005 |
| 29630 | 0.002 |
| 29631 | 0.005 |
| 29632 | 0.005 |
| 29633 | 0.007 |
| 29634 | 0.005 |
| 29635 | 0.007 |
| 29636 | 0.005 |
| 29637 | 0.006 |
| 29638 | 0.004 |
| 29639 | 0.002 |
| 29640 | 0.004 |
| 29641 | 0.003 |
| 29642 | 0.003 |
| 29643 | 0.006 |
| 29644 | 0.002 |
| 29645 | 0.006 |
| 29646 | 0.004 |
| 29647 | 0.006 |
| 29648 | 0.004 |
| 29649 | 0.004 |
| 29650 | 0.007 |
| 29651 | 0.002 |
| 29652 | 0.004 |
| 29653 | 0.003 |
| 29654 | 0.004 |
| 29655 | 0.003 |
| 29656 | 0.002 |
| 29657 | 0.001 |
| 29658 | 0.003 |
| 29659 | 0.001 |
| 29660 | 0.001 |
| 29661 | 0.005 |
| 29662 | 0.002 |
| 29663 | 0.002 |
| 29664 | 0.004 |
| 29665 | 0.003 |
| 29666 | 0.004 |
| 29667 | 0.005 |
| 29668 | 0.004 |
| 29669 | 0.005 |
| 29670 | 0.006 |
| 29671 | 0.007 |
| 29672 | 0.008 |
| 29673 | 0.002 |
| 29674 | 0.006 |
| 29675 | 0.005 |
| 29676 | 0.007 |
| 29677 | 0.002 |
| 29678 | 0.005 |
| 29679 | 0.003 |
| 29680 | 0.004 |
| 29681 | 0.005 |
| 29682 | 0.009 |
| 29683 | 0.011 |
| 29684 | 0.007 |
| 29685 | 0.004 |
| 29686 | 0.003 |
| 29687 | 0.006 |
| 29688 | 0.005 |
| 29689 | 0.004 |
| 29690 | 0.005 |
| 29691 | 0.004 |
| 29692 | 0.003 |
| 29693 | 0.008 |
| 29694 | 0.003 |
| 29695 | 0.005 |
| 29696 | 0.002 |
| 29697 | 0.004 |
| 29698 | 0.006 |
| 29699 | 0.005 |
| 29700 | 0.004 |
| 29701 | 0.004 |
| 29702 | 0.002 |
| 29703 | 0.008 |
| 29704 | 0.009 |
| 29705 | 0.006 |
| 29706 | 0.009 |
| 29707 | 0.009 |
| 29708 | 0.005 |
| 29709 | 0.004 |
| 29710 | 0.002 |
| 29711 | 0.006 |
| 29712 | 0.001 |
| 29713 | 0.006 |
| 29714 | 0.004 |
| 29715 | 0.004 |
| 29716 | 0.001 |
| 29717 | 0.005 |
| 29718 | 0.009 |
| 29719 | 0.001 |
| 29720 | 0.006 |
| 29721 | 0.005 |
| 29722 | 0.003 |
| 29723 | 0.002 |
| 29724 | 0.002 |
| 29725 | 0.004 |
| 29726 | 0.007 |
| 29727 | 0.005 |
| 29728 | 0.003 |
| 29729 | 0.004 |
| 29730 | 0.005 |
| 29731 | 0.007 |
| 29732 | 0.004 |
| 29733 | 0.002 |
| 29734 | 0.003 |
| 29735 | 0.002 |
| 29736 | 0.006 |
| 29737 | 0.003 |
| 29738 | 0.005 |
| 29739 | 0.004 |
| 29740 | 0.009 |
| 29741 | 0.003 |
| 29742 | 0.003 |
| 29743 | 0.004 |
| 29744 | 0.006 |
| 29745 | 0.006 |
| 29746 | 0.005 |
| 29747 | 0.005 |
| 29748 | 0.004 |
| 29749 | 0.004 |
| 29750 | 0.003 |
| 29751 | 0.001 |
| 29752 | 0.004 |
| 29753 | 0.003 |
| 29754 | 0.004 |
| 29755 | 0.005 |
| 29756 | 0.004 |
| 29757 | 0.002 |
| 29758 | 0.003 |
| 29759 | 0.004 |
| 29760 | 0.005 |
| 29761 | 0.003 |
| 29762 | 0.005 |
| 29763 | 0.005 |
| 29764 | 0.003 |
| 29765 | 0.007 |
| 29766 | 0.004 |
| 29767 | 0.002 |
| 29768 | 0.011 |
| 29769 | 0.006 |
| 29770 | 0.003 |
| 29771 | 0.002 |
| 29772 | 0.003 |
| 29773 | 0.01 |
| 29774 | 0.003 |
| 29775 | 0.004 |
| 29776 | 0.007 |
| 29777 | 0.007 |
| 29778 | 0.002 |
| 29779 | 0.001 |
| 29780 | 0.004 |
| 29781 | 0.003 |
| 29782 | 0.004 |
| 29783 | 0.001 |
| 29784 | 0.007 |
| 29785 | 0.004 |
| 29786 | 0.002 |
| 29787 | 0.006 |
| 29788 | 0.002 |
| 29789 | 0.003 |
| 29790 | 0.004 |
| 29791 | 0.002 |
| 29792 | 0.005 |
| 29793 | 0.004 |
| 29794 | 0.004 |
| 29795 | 0.003 |
| 29796 | 0.009 |
| 29797 | 0.012 |
| 29798 | 0.001 |
| 29799 | 0.001 |
| 29800 | 0.002 |
| 29801 | 0.01 |
| 29802 | 0.001 |
| 29803 | 0.004 |
| 29804 | 0.003 |
| 29805 | 0.005 |
| 29806 | 0.001 |
| 29807 | 0.003 |
| 29808 | 0.008 |
| 29809 | 0.013 |
| 29810 | 0.006 |
| 29811 | 0.003 |
| 29812 | 0.004 |
| 29813 | 0.005 |
| 29814 | 0.002 |
| 29815 | 0.002 |
| 29816 | 0.009 |
| 29817 | 0.006 |
| 29818 | 0.004 |
| 29819 | 0.003 |
| 29820 | 0.008 |
| 29821 | 0.008 |
| 29822 | 0.002 |
| 29823 | 0.004 |
| 29824 | 0.001 |
| 29825 | 0.002 |
| 29826 | 0.003 |
| 29827 | 0.005 |
| 29828 | 0.004 |
| 29829 | 0.006 |
| 29830 | 0.001 |
| 29831 | 0.001 |
| 29832 | 0.002 |
| 29833 | 0.003 |
| 29834 | 0.002 |
| 29835 | 0.002 |
| 29836 | 0.006 |
| 29837 | 0.006 |
| 29838 | 0.001 |
| 29839 | 0.003 |
| 29840 | 0.005 |
| 29841 | 0.005 |
| 29842 | 0.002 |
| 29843 | 0.004 |
| 29844 | 0.005 |
| 29845 | 0.004 |
| 29846 | 0.002 |
| 29847 | 0.003 |
| 29848 | 0.002 |
| 29849 | 0.003 |
| 29850 | 0.002 |
| 29851 | 0.001 |
| 29852 | 0.006 |
| 29853 | 0.007 |
| 29854 | 0.004 |
| 29855 | 0.003 |
| 29856 | 0.004 |
| 29857 | 0.005 |
| 29858 | 0.001 |
| 29859 | 0.004 |
| 29860 | 0.004 |
| 29861 | 0.003 |
| 29862 | 0.002 |
| 29863 | 0.002 |
| 29864 | 0.004 |
| 29865 | 0.002 |
| 29866 | 0.002 |
| 29867 | 0.002 |
| 29868 | 0.006 |
| 29869 | 0.005 |
| 29870 | 0.004 |
| 29871 | 0.003 |
| 29872 | 0.004 |
| 29873 | 0.011 |
| 29874 | 0.002 |
| 29875 | 0.002 |
| 29876 | 0.007 |
| 29877 | 0.006 |
| 29878 | 0.003 |
| 29879 | 0.003 |
| 29880 | 0.001 |
| 29881 | 0.007 |
| 29882 | 0.002 |
| 29883 | 0.005 |
| 29884 | 0.004 |
| 29885 | 0.001 |
| 29886 | 0.003 |
| 29887 | 0.006 |
| 29888 | 0.002 |
| 29889 | 0.008 |
| 29890 | 0.002 |
| 29891 | 0.001 |
| 29892 | 0.002 |
| 29893 | 0.004 |
| 29894 | 0.001 |
| 29895 | 0.002 |
| 29896 | 0.007 |
| 29897 | 0.004 |
| 29898 | 0.003 |
| 29899 | 0.005 |
| 29900 | 0.005 |
| 29901 | 0.016 |
| 29902 | 0.008 |
| 29903 | 0.005 |
| 29904 | 0.007 |
| 29905 | 0.002 |
| 29906 | 0.002 |
| 29907 | 0.003 |
| 29908 | 0.006 |
| 29909 | 0.004 |
| 29910 | 0.005 |
| 29911 | 0.008 |
| 29912 | 0.005 |
| 29913 | 0.003 |
| 29914 | 0.001 |
| 29915 | 0.003 |
| 29916 | 0.005 |
| 29917 | 0.004 |
| 29918 | 0.002 |
| 29919 | 0.001 |
| 29920 | 0.004 |
| 29921 | 0.003 |
| 29922 | 0.004 |
| 29923 | 0.004 |
| 29924 | 0.006 |
| 29925 | 0.004 |
| 29926 | 0.002 |
| 29927 | 0.002 |
| 29928 | 0.002 |
| 29929 | 0.01 |
| 29930 | 0.002 |
| 29931 | 0.004 |
| 29932 | 0.003 |
| 29933 | 0.003 |
| 29934 | 0.003 |
| 29935 | 0.009 |
| 29936 | 0.005 |
| 29937 | 0.004 |
| 29938 | 0.002 |
| 29939 | 0.004 |
| 29940 | 0.007 |
| 29941 | 0.008 |
| 29942 | 0.007 |
| 29943 | 0.005 |
| 29944 | 0.009 |
| 29945 | 0.002 |
| 29946 | 0.002 |
| 29947 | 0.002 |
| 29948 | 0.002 |
| 29949 | 0.006 |
| 29950 | 0.003 |
| 29951 | 0.004 |
| 29952 | 0.007 |
| 29953 | 0.004 |
| 29954 | 0.002 |
| 29955 | 0.004 |
| 29956 | 0.004 |
| 29957 | 0.006 |
| 29958 | 0.005 |
| 29959 | 0.007 |
| 29960 | 0.006 |
| 29961 | 0.001 |
| 29962 | 0.002 |
| 29963 | 0.003 |
| 29964 | 0.004 |
| 29965 | 0.001 |
| 29966 | 0.001 |
| 29967 | 0.002 |
| 29968 | 0.005 |
| 29969 | 0.005 |
| 29970 | 0.002 |
| 29971 | 0.005 |
| 29972 | 0.008 |
| 29973 | 0.01 |
| 29974 | 0.001 |
| 29975 | 0.002 |
| 29976 | 0.006 |
| 29977 | 0.004 |
| 29978 | 0.002 |
| 29979 | 0.005 |
| 29980 | 0.004 |
| 29981 | 0.005 |
| 29982 | 0.001 |
| 29983 | 0.005 |
| 29984 | 0.008 |
| 29985 | 0.005 |
| 29986 | 0.002 |
| 29987 | 0.002 |
| 29988 | 0.003 |
| 29989 | 0.01 |
| 29990 | 0.008 |
| 29991 | 0.007 |
| 29992 | 0.004 |
| 29993 | 0.003 |
| 29994 | 0.002 |
| 29995 | 0.005 |
| 29996 | 0.006 |
| 29997 | 0.002 |
| 29998 | 0.006 |
| 29999 | 0.001 |
| 30000 | 0.002 |
| 30001 | 0.002 |
| 30002 | 0.008 |
| 30003 | 0.005 |
| 30004 | 0.007 |
| 30005 | 0.002 |
| 30006 | 0.004 |
| 30007 | 0.006 |
| 30008 | 0.005 |
| 30009 | 0.002 |
| 30010 | 0.002 |
| 30011 | 0.002 |
| 30012 | 0.007 |
| 30013 | 0.003 |
| 30014 | 0.002 |
| 30015 | 0.001 |
| 30016 | 0.006 |
| 30017 | 0.003 |
| 30018 | 0.005 |
| 30019 | 0.004 |
| 30020 | 0.007 |
| 30021 | 0.008 |
| 30022 | 0.003 |
| 30023 | 0.003 |
| 30024 | 0.002 |
| 30025 | 0.006 |
| 30026 | 0.002 |
| 30027 | 0.005 |
| 30028 | 0.002 |
| 30029 | 0.004 |
| 30030 | 0.008 |
| 30031 | 0.006 |
| 30032 | 0.004 |
| 30033 | 0.001 |
| 30034 | 0.003 |
| 30035 | 0.004 |
| 30036 | 0.005 |
| 30037 | 0.006 |
| 30038 | 0.001 |
| 30039 | 0.002 |
| 30040 | 0.005 |
| 30041 | 0.003 |
| 30042 | 0.002 |
| 30043 | 0.002 |
| 30044 | 0.003 |
| 30045 | 0.012 |
| 30046 | 0.007 |
| 30047 | 0.006 |
| 30048 | 0.008 |
| 30049 | 0.001 |
| 30050 | 0.002 |
| 30051 | 0.004 |
| 30052 | 0.003 |
| 30053 | 0.003 |
| 30054 | 0.003 |
| 30055 | 0.004 |
| 30056 | 0.005 |
| 30057 | 0.001 |
| 30058 | 0.006 |
| 30059 | 0.004 |
| 30060 | 0.01 |
| 30061 | 0.004 |
| 30062 | 0.004 |
| 30063 | 0.007 |
| 30064 | 0.006 |
| 30065 | 0.003 |
| 30066 | 0.004 |
| 30067 | 0.007 |
| 30068 | 0.006 |
| 30069 | 0.002 |
| 30070 | 0.004 |
| 30071 | 0.007 |
| 30072 | 0.007 |
| 30073 | 0.003 |
| 30074 | 0.003 |
| 30075 | 0.003 |
| 30076 | 0.003 |
| 30077 | 0.007 |
| 30078 | 0.004 |
| 30079 | 0.002 |
| 30080 | 0.003 |
| 30081 | 0.003 |
| 30082 | 0.004 |
| 30083 | 0.002 |
| 30084 | 0.009 |
| 30085 | 0.002 |
| 30086 | 0.003 |
| 30087 | 0.002 |
| 30088 | 0.004 |
| 30089 | 0.003 |
| 30090 | 0.001 |
| 30091 | 0.003 |
| 30092 | 0.005 |
| 30093 | 0.002 |
| 30094 | 0.002 |
| 30095 | 0.005 |
| 30096 | 0.012 |
| 30097 | 0.003 |
| 30098 | 0.001 |
| 30099 | 0.011 |
| 30100 | 0.015 |
| 30101 | 0.002 |
| 30102 | 0.004 |
| 30103 | 0.002 |
| 30104 | 0.004 |
| 30105 | 0.008 |
| 30106 | 0.001 |
| 30107 | 0.003 |
| 30108 | 0.003 |
| 30109 | 0.002 |
| 30110 | 0.006 |
| 30111 | 0.006 |
| 30112 | 0.006 |
| 30113 | 0.005 |
| 30114 | 0.005 |
| 30115 | 0.005 |
| 30116 | 0.009 |
| 30117 | 0.003 |
| 30118 | 0.003 |
| 30119 | 0.008 |
| 30120 | 0.007 |
| 30121 | 0.001 |
| 30122 | 0.002 |
| 30123 | 0.003 |
| 30124 | 0.002 |
| 30125 | 0.003 |
| 30126 | 0.004 |
| 30127 | 0.002 |
| 30128 | 0.002 |
| 30129 | 0.003 |
| 30130 | 0.004 |
| 30131 | 0.006 |
| 30132 | 0.005 |
| 30133 | 0.006 |
| 30134 | 0.005 |
| 30135 | 0.007 |
| 30136 | 0.004 |
| 30137 | 0.004 |
| 30138 | 0.009 |
| 30139 | 0.002 |
| 30140 | 0.002 |
| 30141 | 0.002 |
| 30142 | 0.002 |
| 30143 | 0.003 |
| 30144 | 0.007 |
| 30145 | 0.002 |
| 30146 | 0.001 |
| 30147 | 0.009 |
| 30148 | 0.008 |
| 30149 | 0.003 |
| 30150 | 0.004 |
| 30151 | 0.002 |
| 30152 | 0.002 |
| 30153 | 0.003 |
| 30154 | 0.003 |
| 30155 | 0.003 |
| 30156 | 0.008 |
| 30157 | 0.007 |
| 30158 | 0.007 |
| 30159 | 0.003 |
| 30160 | 0.007 |
| 30161 | 0.002 |
| 30162 | 0.005 |
| 30163 | 0.008 |
| 30164 | 0.002 |
| 30165 | 0.002 |
| 30166 | 0.002 |
| 30167 | 0.009 |
| 30168 | 0.01 |
| 30169 | 0.001 |
| 30170 | 0.001 |
| 30171 | 0.002 |
| 30172 | 0.002 |
| 30173 | 0.003 |
| 30174 | 0.006 |
| 30175 | 0.006 |
| 30176 | 0.007 |
| 30177 | 0 |
| 30178 | 0.003 |
| 30179 | 0.003 |
| 30180 | 0.004 |
| 30181 | 0.005 |
| 30182 | 0.004 |
| 30183 | 0.008 |
| 30184 | 0.008 |
| 30185 | 0.002 |
| 30186 | 0.005 |
| 30187 | 0.001 |
| 30188 | 0.006 |
| 30189 | 0.005 |
| 30190 | 0.003 |
| 30191 | 0.01 |
| 30192 | 0.005 |
| 30193 | 0.003 |
| 30194 | 0.003 |
| 30195 | 0.002 |
| 30196 | 0.001 |
| 30197 | 0.009 |
| 30198 | 0.002 |
| 30199 | 0.005 |
| 30200 | 0.005 |
| 30201 | 0.004 |
| 30202 | 0.004 |
| 30203 | 0.005 |
| 30204 | 0.002 |
| 30205 | 0.003 |
| 30206 | 0.004 |
| 30207 | 0.01 |
| 30208 | 0.006 |
| 30209 | 0.002 |
| 30210 | 0.006 |
| 30211 | 0.004 |
| 30212 | 0.005 |
| 30213 | 0.002 |
| 30214 | 0.004 |
| 30215 | 0.003 |
| 30216 | 0.003 |
| 30217 | 0.002 |
| 30218 | 0.002 |
| 30219 | 0.007 |
| 30220 | 0.008 |
| 30221 | 0.006 |
| 30222 | 0.002 |
| 30223 | 0.005 |
| 30224 | 0.003 |
| 30225 | 0.002 |
| 30226 | 0.003 |
| 30227 | 0.002 |
| 30228 | 0.006 |
| 30229 | 0.006 |
| 30230 | 0.002 |
| 30231 | 0.006 |
| 30232 | 0.005 |
| 30233 | 0.003 |
| 30234 | 0.005 |
| 30235 | 0.006 |
| 30236 | 0.004 |
| 30237 | 0.002 |
| 30238 | 0 |
| 30239 | 0.004 |
| 30240 | 0.005 |
| 30241 | 0.003 |
| 30242 | 0.002 |
| 30243 | 0.009 |
| 30244 | 0.003 |
| 30245 | 0.002 |
| 30246 | 0.003 |
| 30247 | 0.008 |
| 30248 | 0.003 |
| 30249 | 0.007 |
| 30250 | 0.006 |
| 30251 | 0.006 |
| 30252 | 0.006 |
| 30253 | 0.003 |
| 30254 | 0.003 |
| 30255 | 0.003 |
| 30256 | 0.007 |
| 30257 | 0.006 |
| 30258 | 0.002 |
| 30259 | 0.002 |
| 30260 | 0.003 |
| 30261 | 0.006 |
| 30262 | 0.002 |
| 30263 | 0.002 |
| 30264 | 0.005 |
| 30265 | 0.009 |
| 30266 | 0.003 |
| 30267 | 0.005 |
| 30268 | 0.007 |
| 30269 | 0.004 |
| 30270 | 0.005 |
| 30271 | 0.003 |
| 30272 | 0.006 |
| 30273 | 0.001 |
| 30274 | 0.004 |
| 30275 | 0.002 |
| 30276 | 0.002 |
| 30277 | 0.005 |
| 30278 | 0.003 |
| 30279 | 0.006 |
| 30280 | 0.003 |
| 30281 | 0.006 |
| 30282 | 0.003 |
| 30283 | 0.003 |
| 30284 | 0.002 |
| 30285 | 0.006 |
| 30286 | 0.002 |
| 30287 | 0.005 |
| 30288 | 0.003 |
| 30289 | 0.005 |
| 30290 | 0.003 |
| 30291 | 0.003 |
| 30292 | 0.006 |
| 30293 | 0.001 |
| 30294 | 0.006 |
| 30295 | 0.001 |
| 30296 | 0.004 |
| 30297 | 0.009 |
| 30298 | 0.009 |
| 30299 | 0.01 |
| 30300 | 0.002 |
| 30301 | 0.003 |
| 30302 | 0.004 |
| 30303 | 0.002 |
| 30304 | 0.006 |
| 30305 | 0.006 |
| 30306 | 0.002 |
| 30307 | 0.005 |
| 30308 | 0.004 |
| 30309 | 0.006 |
| 30310 | 0.003 |
| 30311 | 0.003 |
| 30312 | 0.005 |
| 30313 | 0.005 |
| 30314 | 0.005 |
| 30315 | 0.007 |
| 30316 | 0.006 |
| 30317 | 0.004 |
| 30318 | 0.004 |
| 30319 | 0.007 |
| 30320 | 0.005 |
| 30321 | 0.006 |
| 30322 | 0.006 |
| 30323 | 0.007 |
| 30324 | 0.006 |
| 30325 | 0.003 |
| 30326 | 0.006 |
| 30327 | 0.002 |
| 30328 | 0.002 |
| 30329 | 0.004 |
| 30330 | 0.001 |
| 30331 | 0.005 |
| 30332 | 0.009 |
| 30333 | 0.008 |
| 30334 | 0.002 |
| 30335 | 0.002 |
| 30336 | 0.004 |
| 30337 | 0.003 |
| 30338 | 0.003 |
| 30339 | 0.005 |
| 30340 | 0.008 |
| 30341 | 0.002 |
| 30342 | 0.005 |
| 30343 | 0.002 |
| 30344 | 0.006 |
| 30345 | 0.002 |
| 30346 | 0.005 |
| 30347 | 0.003 |
| 30348 | 0.004 |
| 30349 | 0.003 |
| 30350 | 0.006 |
| 30351 | 0.001 |
| 30352 | 0.001 |
| 30353 | 0.004 |
| 30354 | 0.006 |
| 30355 | 0.007 |
| 30356 | 0.006 |
| 30357 | 0.002 |
| 30358 | 0.003 |
| 30359 | 0.003 |
| 30360 | 0.005 |
| 30361 | 0.001 |
| 30362 | 0.003 |
| 30363 | 0.003 |
| 30364 | 0.003 |
| 30365 | 0.006 |
| 30366 | 0.002 |
| 30367 | 0.001 |
| 30368 | 0.006 |
| 30369 | 0.001 |
| 30370 | 0.002 |
| 30371 | 0.002 |
| 30372 | 0.007 |
| 30373 | 0.002 |
| 30374 | 0.001 |
| 30375 | 0.003 |
| 30376 | 0.004 |
| 30377 | 0.003 |
| 30378 | 0.002 |
| 30379 | 0.002 |
| 30380 | 0.009 |
| 30381 | 0.002 |
| 30382 | 0.004 |
| 30383 | 0.004 |
| 30384 | 0.007 |
| 30385 | 0.007 |
| 30386 | 0.002 |
| 30387 | 0.002 |
| 30388 | 0.004 |
| 30389 | 0.003 |
| 30390 | 0.003 |
| 30391 | 0.005 |
| 30392 | 0.008 |
| 30393 | 0.009 |
| 30394 | 0.007 |
| 30395 | 0.005 |
| 30396 | 0.004 |
| 30397 | 0.002 |
| 30398 | 0.002 |
| 30399 | 0.007 |
| 30400 | 0.007 |
| 30401 | 0.002 |
| 30402 | 0.004 |
| 30403 | 0.003 |
| 30404 | 0.005 |
| 30405 | 0.003 |
| 30406 | 0.004 |
| 30407 | 0.002 |
| 30408 | 0.005 |
| 30409 | 0.002 |
| 30410 | 0.003 |
| 30411 | 0.005 |
| 30412 | 0.011 |
| 30413 | 0.003 |
| 30414 | 0.005 |
| 30415 | 0.011 |
| 30416 | 0.006 |
| 30417 | 0.003 |
| 30418 | 0.004 |
| 30419 | 0.003 |
| 30420 | 0.006 |
| 30421 | 0.002 |
| 30422 | 0.002 |
| 30423 | 0.009 |
| 30424 | 0.01 |
| 30425 | 0.006 |
| 30426 | 0.001 |
| 30427 | 0.002 |
| 30428 | 0.008 |
| 30429 | 0.01 |
| 30430 | 0.004 |
| 30431 | 0.003 |
| 30432 | 0.005 |
| 30433 | 0.006 |
| 30434 | 0.004 |
| 30435 | 0.001 |
| 30436 | 0.005 |
| 30437 | 0.007 |
| 30438 | 0.002 |
| 30439 | 0.003 |
| 30440 | 0.005 |
| 30441 | 0.007 |
| 30442 | 0.003 |
| 30443 | 0.005 |
| 30444 | 0.005 |
| 30445 | 0.005 |
| 30446 | 0.001 |
| 30447 | 0.004 |
| 30448 | 0.003 |
| 30449 | 0.004 |
| 30450 | 0.001 |
| 30451 | 0.003 |
| 30452 | 0.006 |
| 30453 | 0.003 |
| 30454 | 0.002 |
| 30455 | 0.001 |
| 30456 | 0.009 |
| 30457 | 0.007 |
| 30458 | 0.003 |
| 30459 | 0.005 |
| 30460 | 0.007 |
| 30461 | 0.013 |
| 30462 | 0.001 |
| 30463 | 0.006 |
| 30464 | 0.008 |
| 30465 | 0.01 |
| 30466 | 0.004 |
| 30467 | 0.005 |
| 30468 | 0.006 |
| 30469 | 0.005 |
| 30470 | 0.004 |
| 30471 | 0.006 |
| 30472 | 0.002 |
| 30473 | 0.004 |
| 30474 | 0.002 |
| 30475 | 0.003 |
| 30476 | 0.006 |
| 30477 | 0.002 |
| 30478 | 0.003 |
| 30479 | 0.003 |
| 30480 | 0.004 |
| 30481 | 0.003 |
| 30482 | 0.002 |
| 30483 | 0.003 |
| 30484 | 0.008 |
| 30485 | 0.007 |
| 30486 | 0.004 |
| 30487 | 0.005 |
| 30488 | 0.003 |
| 30489 | 0.005 |
| 30490 | 0.004 |
| 30491 | 0.003 |
| 30492 | 0.001 |
| 30493 | 0.009 |
| 30494 | 0.002 |
| 30495 | 0.003 |
| 30496 | 0.003 |
| 30497 | 0.004 |
| 30498 | 0.002 |
| 30499 | 0.003 |
| 30500 | 0.003 |
| 30501 | 0.006 |
| 30502 | 0.002 |
| 30503 | 0.002 |
| 30504 | 0.005 |
| 30505 | 0.009 |
| 30506 | 0.004 |
| 30507 | 0.003 |
| 30508 | 0.005 |
| 30509 | 0.004 |
| 30510 | 0.003 |
| 30511 | 0.005 |
| 30512 | 0.004 |
| 30513 | 0.011 |
| 30514 | 0.002 |
| 30515 | 0.005 |
| 30516 | 0.004 |
| 30517 | 0.004 |
| 30518 | 0.005 |
| 30519 | 0.007 |
| 30520 | 0.005 |
| 30521 | 0.007 |
| 30522 | 0.005 |
| 30523 | 0.003 |
| 30524 | 0.004 |
| 30525 | 0.003 |
| 30526 | 0.002 |
| 30527 | 0.002 |
| 30528 | 0.003 |
| 30529 | 0.006 |
| 30530 | 0.001 |
| 30531 | 0.002 |
| 30532 | 0.01 |
| 30533 | 0.005 |
| 30534 | 0.004 |
| 30535 | 0.002 |
| 30536 | 0.003 |
| 30537 | 0.012 |
| 30538 | 0.004 |
| 30539 | 0.006 |
| 30540 | 0.008 |
| 30541 | 0.003 |
| 30542 | 0.002 |
| 30543 | 0.002 |
| 30544 | 0.005 |
| 30545 | 0.002 |
| 30546 | 0.002 |
| 30547 | 0.004 |
| 30548 | 0.002 |
| 30549 | 0.006 |
| 30550 | 0.003 |
| 30551 | 0.001 |
| 30552 | 0.001 |
| 30553 | 0.004 |
| 30554 | 0.002 |
| 30555 | 0.002 |
| 30556 | 0.003 |
| 30557 | 0.004 |
| 30558 | 0.001 |
| 30559 | 0.002 |
| 30560 | 0.004 |
| 30561 | 0.003 |
| 30562 | 0.002 |
| 30563 | 0.003 |
| 30564 | 0.004 |
| 30565 | 0.005 |
| 30566 | 0.002 |
| 30567 | 0.004 |
| 30568 | 0.005 |
| 30569 | 0.002 |
| 30570 | 0.003 |
| 30571 | 0.006 |
| 30572 | 0.003 |
| 30573 | 0.003 |
| 30574 | 0.002 |
| 30575 | 0.003 |
| 30576 | 0.002 |
| 30577 | 0.002 |
| 30578 | 0.004 |
| 30579 | 0.004 |
| 30580 | 0.002 |
| 30581 | 0.004 |
| 30582 | 0.003 |
| 30583 | 0.004 |
| 30584 | 0.002 |
| 30585 | 0.004 |
| 30586 | 0.002 |
| 30587 | 0.003 |
| 30588 | 0.001 |
| 30589 | 0.004 |
| 30590 | 0.001 |
| 30591 | 0.002 |
| 30592 | 0.002 |
| 30593 | 0.007 |
| 30594 | 0.005 |
| 30595 | 0.005 |
| 30596 | 0.003 |
| 30597 | 0.005 |
| 30598 | 0.005 |
| 30599 | 0.004 |
| 30600 | 0.007 |
| 30601 | 0.002 |
| 30602 | 0.003 |
| 30603 | 0.003 |
| 30604 | 0.009 |
| 30605 | 0.008 |
| 30606 | 0.002 |
| 30607 | 0.002 |
| 30608 | 0.003 |
| 30609 | 0.002 |
| 30610 | 0.005 |
| 30611 | 0.005 |
| 30612 | 0.011 |
| 30613 | 0.008 |
| 30614 | 0.012 |
| 30615 | 0.009 |
| 30616 | 0.006 |
| 30617 | 0.001 |
| 30618 | 0.004 |
| 30619 | 0.005 |
| 30620 | 0.003 |
| 30621 | 0.003 |
| 30622 | 0.008 |
| 30623 | 0.004 |
| 30624 | 0.005 |
| 30625 | 0.006 |
| 30626 | 0.006 |
| 30627 | 0.003 |
| 30628 | 0.007 |
| 30629 | 0.007 |
| 30630 | 0.003 |
| 30631 | 0.001 |
| 30632 | 0.003 |
| 30633 | 0.008 |
| 30634 | 0.004 |
| 30635 | 0.003 |
| 30636 | 0.007 |
| 30637 | 0.004 |
| 30638 | 0.009 |
| 30639 | 0.004 |
| 30640 | 0.005 |
| 30641 | 0.003 |
| 30642 | 0.001 |
| 30643 | 0.005 |
| 30644 | 0.001 |
| 30645 | 0.003 |
| 30646 | 0.001 |
| 30647 | 0.005 |
| 30648 | 0.012 |
| 30649 | 0.005 |
| 30650 | 0.006 |
| 30651 | 0.003 |
| 30652 | 0.006 |
| 30653 | 0.002 |
| 30654 | 0.007 |
| 30655 | 0.004 |
| 30656 | 0.005 |
| 30657 | 0.005 |
| 30658 | 0.002 |
| 30659 | 0.005 |
| 30660 | 0.008 |
| 30661 | 0.006 |
| 30662 | 0.001 |
| 30663 | 0.002 |
| 30664 | 0.003 |
| 30665 | 0.004 |
| 30666 | 0.003 |
| 30667 | 0.002 |
| 30668 | 0.004 |
| 30669 | 0.007 |
| 30670 | 0.003 |
| 30671 | 0.001 |
| 30672 | 0.005 |
| 30673 | 0.009 |
| 30674 | 0.002 |
| 30675 | 0.001 |
| 30676 | 0.002 |
| 30677 | 0.002 |
| 30678 | 0.003 |
| 30679 | 0.007 |
| 30680 | 0.007 |
| 30681 | 0.004 |
| 30682 | 0.002 |
| 30683 | 0.006 |
| 30684 | 0.005 |
| 30685 | 0.002 |
| 30686 | 0.004 |
| 30687 | 0.003 |
| 30688 | 0.008 |
| 30689 | 0.003 |
| 30690 | 0.003 |
| 30691 | 0.003 |
| 30692 | 0.009 |
| 30693 | 0.003 |
| 30694 | 0.004 |
| 30695 | 0.003 |
| 30696 | 0.006 |
| 30697 | 0.004 |
| 30698 | 0.007 |
| 30699 | 0.005 |
| 30700 | 0.009 |
| 30701 | 0.003 |
| 30702 | 0.003 |
| 30703 | 0.01 |
| 30704 | 0 |
| 30705 | 0.003 |
| 30706 | 0.003 |
| 30707 | 0.007 |
| 30708 | 0.009 |
| 30709 | 0.001 |
| 30710 | 0.001 |
| 30711 | 0.006 |
| 30712 | 0.004 |
| 30713 | 0.002 |
| 30714 | 0.003 |
| 30715 | 0.01 |
| 30716 | 0.006 |
| 30717 | 0.005 |
| 30718 | 0.006 |
| 30719 | 0.008 |
| 30720 | 0.004 |
| 30721 | 0.002 |
| 30722 | 0.003 |
| 30723 | 0.006 |
| 30724 | 0.011 |
| 30725 | 0.006 |
| 30726 | 0.003 |
| 30727 | 0.004 |
| 30728 | 0.009 |
| 30729 | 0.002 |
| 30730 | 0.003 |
| 30731 | 0.002 |
| 30732 | 0.003 |
| 30733 | 0.003 |
| 30734 | 0.001 |
| 30735 | 0.003 |
| 30736 | 0.003 |
| 30737 | 0.002 |
| 30738 | 0.004 |
| 30739 | 0.003 |
| 30740 | 0.003 |
| 30741 | 0.001 |
| 30742 | 0.005 |
| 30743 | 0.008 |
| 30744 | 0.004 |
| 30745 | 0.002 |
| 30746 | 0.003 |
| 30747 | 0.012 |
| 30748 | 0.007 |
| 30749 | 0.004 |
| 30750 | 0.004 |
| 30751 | 0.004 |
| 30752 | 0.009 |
| 30753 | 0.003 |
| 30754 | 0.005 |
| 30755 | 0.005 |
| 30756 | 0.005 |
| 30757 | 0.004 |
| 30758 | 0.002 |
| 30759 | 0.004 |
| 30760 | 0.003 |
| 30761 | 0.005 |
| 30762 | 0.004 |
| 30763 | 0.002 |
| 30764 | 0.006 |
| 30765 | 0.002 |
| 30766 | 0.003 |
| 30767 | 0.003 |
| 30768 | 0.007 |
| 30769 | 0.004 |
| 30770 | 0.003 |
| 30771 | 0.002 |
| 30772 | 0.006 |
| 30773 | 0.005 |
| 30774 | 0.005 |
| 30775 | 0.002 |
| 30776 | 0.005 |
| 30777 | 0.004 |
| 30778 | 0.004 |
| 30779 | 0.001 |
| 30780 | 0.003 |
| 30781 | 0.006 |
| 30782 | 0.004 |
| 30783 | 0.004 |
| 30784 | 0.001 |
| 30785 | 0.002 |
| 30786 | 0.003 |
| 30787 | 0.001 |
| 30788 | 0.005 |
| 30789 | 0.006 |
| 30790 | 0.001 |
| 30791 | 0.002 |
| 30792 | 0.009 |
| 30793 | 0.003 |
| 30794 | 0.001 |
| 30795 | 0.002 |
| 30796 | 0.004 |
| 30797 | 0.008 |
| 30798 | 0.003 |
| 30799 | 0.004 |
| 30800 | 0.006 |
| 30801 | 0.009 |
| 30802 | 0.001 |
| 30803 | 0.002 |
| 30804 | 0.004 |
| 30805 | 0.007 |
| 30806 | 0.004 |
| 30807 | 0.007 |
| 30808 | 0.002 |
| 30809 | 0.008 |
| 30810 | 0.007 |
| 30811 | 0.002 |
| 30812 | 0.002 |
| 30813 | 0.003 |
| 30814 | 0.003 |
| 30815 | 0.007 |
| 30816 | 0.004 |
| 30817 | 0.002 |
| 30818 | 0.002 |
| 30819 | 0.003 |
| 30820 | 0.005 |
| 30821 | 0.002 |
| 30822 | 0.005 |
| 30823 | 0.008 |
| 30824 | 0.005 |
| 30825 | 0.001 |
| 30826 | 0.006 |
| 30827 | 0.005 |
| 30828 | 0.004 |
| 30829 | 0.001 |
| 30830 | 0.003 |
| 30831 | 0.004 |
| 30832 | 0.003 |
| 30833 | 0.001 |
| 30834 | 0.003 |
| 30835 | 0.003 |
| 30836 | 0.003 |
| 30837 | 0.001 |
| 30838 | 0.002 |
| 30839 | 0.003 |
| 30840 | 0.005 |
| 30841 | 0.001 |
| 30842 | 0.002 |
| 30843 | 0.003 |
| 30844 | 0.01 |
| 30845 | 0.002 |
| 30846 | 0.003 |
| 30847 | 0.006 |
| 30848 | 0.004 |
| 30849 | 0.006 |
| 30850 | 0.006 |
| 30851 | 0.003 |
| 30852 | 0.006 |
| 30853 | 0.003 |
| 30854 | 0.003 |
| 30855 | 0.007 |
| 30856 | 0.006 |
| 30857 | 0.004 |
| 30858 | 0.003 |
| 30859 | 0.005 |
| 30860 | 0.001 |
| 30861 | 0.007 |
| 30862 | 0.004 |
| 30863 | 0.004 |
| 30864 | 0.005 |
| 30865 | 0.006 |
| 30866 | 0.003 |
| 30867 | 0.004 |
| 30868 | 0.006 |
| 30869 | 0.003 |
| 30870 | 0.004 |
| 30871 | 0.004 |
| 30872 | 0.006 |
| 30873 | 0.003 |
| 30874 | 0.004 |
| 30875 | 0.001 |
| 30876 | 0.002 |
| 30877 | 0.001 |
| 30878 | 0.004 |
| 30879 | 0.002 |
| 30880 | 0.004 |
| 30881 | 0.003 |
| 30882 | 0.005 |
| 30883 | 0.002 |
| 30884 | 0.003 |
| 30885 | 0.007 |
| 30886 | 0.003 |
| 30887 | 0.007 |
| 30888 | 0.002 |
| 30889 | 0.002 |
| 30890 | 0.004 |
| 30891 | 0.006 |
| 30892 | 0.003 |
| 30893 | 0.003 |
| 30894 | 0.004 |
| 30895 | 0.004 |
| 30896 | 0.004 |
| 30897 | 0.007 |
| 30898 | 0.006 |
| 30899 | 0.004 |
| 30900 | 0.005 |
| 30901 | 0.002 |
| 30902 | 0.005 |
| 30903 | 0.004 |
| 30904 | 0.003 |
| 30905 | 0.003 |
| 30906 | 0.001 |
| 30907 | 0.003 |
| 30908 | 0.001 |
| 30909 | 0.003 |
| 30910 | 0.006 |
| 30911 | 0.003 |
| 30912 | 0.005 |
| 30913 | 0.005 |
| 30914 | 0.005 |
| 30915 | 0.005 |
| 30916 | 0.006 |
| 30917 | 0.01 |
| 30918 | 0.004 |
| 30919 | 0.003 |
| 30920 | 0.006 |
| 30921 | 0.002 |
| 30922 | 0.006 |
| 30923 | 0.004 |
| 30924 | 0.004 |
| 30925 | 0.004 |
| 30926 | 0.007 |
| 30927 | 0.003 |
| 30928 | 0.005 |
| 30929 | 0.006 |
| 30930 | 0.005 |
| 30931 | 0.009 |
| 30932 | 0.011 |
| 30933 | 0.009 |
| 30934 | 0.004 |
| 30935 | 0.004 |
| 30936 | 0.004 |
| 30937 | 0.011 |
| 30938 | 0.006 |
| 30939 | 0.003 |
| 30940 | 0.004 |
| 30941 | 0.006 |
| 30942 | 0.004 |
| 30943 | 0.002 |
| 30944 | 0.004 |
| 30945 | 0.005 |
| 30946 | 0.001 |
| 30947 | 0.008 |
| 30948 | 0.009 |
| 30949 | 0.008 |
| 30950 | 0.011 |
| 30951 | 0.003 |
| 30952 | 0.004 |
| 30953 | 0.004 |
| 30954 | 0.005 |
| 30955 | 0.007 |
| 30956 | 0.005 |
| 30957 | 0.007 |
| 30958 | 0.006 |
| 30959 | 0.005 |
| 30960 | 0.003 |
| 30961 | 0.001 |
| 30962 | 0.003 |
| 30963 | 0.002 |
| 30964 | 0.007 |
| 30965 | 0.01 |
| 30966 | 0.003 |
| 30967 | 0.004 |
| 30968 | 0.003 |
| 30969 | 0.005 |
| 30970 | 0.009 |
| 30971 | 0.011 |
| 30972 | 0.006 |
| 30973 | 0.005 |
| 30974 | 0.003 |
| 30975 | 0.001 |
| 30976 | 0.004 |
| 30977 | 0.002 |
| 30978 | 0.004 |
| 30979 | 0.004 |
| 30980 | 0.007 |
| 30981 | 0.002 |
| 30982 | 0.006 |
| 30983 | 0.003 |
| 30984 | 0.005 |
| 30985 | 0.002 |
| 30986 | 0.004 |
| 30987 | 0.008 |
| 30988 | 0.007 |
| 30989 | 0.004 |
| 30990 | 0.006 |
| 30991 | 0.01 |
| 30992 | 0.002 |
| 30993 | 0.003 |
| 30994 | 0.005 |
| 30995 | 0.004 |
| 30996 | 0.005 |
| 30997 | 0.003 |
| 30998 | 0.002 |
| 30999 | 0.005 |
| 31000 | 0.004 |
| 31001 | 0.004 |
| 31002 | 0.002 |
| 31003 | 0.008 |
| 31004 | 0.009 |
| 31005 | 0.003 |
| 31006 | 0.002 |
| 31007 | 0.007 |
| 31008 | 0.004 |
| 31009 | 0.002 |
| 31010 | 0.004 |
| 31011 | 0.004 |
| 31012 | 0.005 |
| 31013 | 0.003 |
| 31014 | 0.001 |
| 31015 | 0.001 |
| 31016 | 0.005 |
| 31017 | 0.002 |
| 31018 | 0.002 |
| 31019 | 0.004 |
| 31020 | 0.003 |
| 31021 | 0.002 |
| 31022 | 0.003 |
| 31023 | 0.003 |
| 31024 | 0.003 |
| 31025 | 0.003 |
| 31026 | 0.003 |
| 31027 | 0.009 |
| 31028 | 0.01 |
| 31029 | 0.003 |
| 31030 | 0.002 |
| 31031 | 0.004 |
| 31032 | 0.003 |
| 31033 | 0.005 |
| 31034 | 0.003 |
| 31035 | 0.003 |
| 31036 | 0.004 |
| 31037 | 0.002 |
| 31038 | 0.004 |
| 31039 | 0.007 |
| 31040 | 0.005 |
| 31041 | 0.003 |
| 31042 | 0.007 |
| 31043 | 0.012 |
| 31044 | 0.01 |
| 31045 | 0.001 |
| 31046 | 0.004 |
| 31047 | 0.007 |
| 31048 | 0.006 |
| 31049 | 0.008 |
| 31050 | 0.005 |
| 31051 | 0.007 |
| 31052 | 0.004 |
| 31053 | 0.002 |
| 31054 | 0.001 |
| 31055 | 0.003 |
| 31056 | 0.003 |
| 31057 | 0.003 |
| 31058 | 0.004 |
| 31059 | 0.006 |
| 31060 | 0.007 |
| 31061 | 0.003 |
| 31062 | 0.002 |
| 31063 | 0.005 |
| 31064 | 0.006 |
| 31065 | 0.002 |
| 31066 | 0.004 |
| 31067 | 0.003 |
| 31068 | 0.001 |
| 31069 | 0.001 |
| 31070 | 0.003 |
| 31071 | 0.004 |
| 31072 | 0.008 |
| 31073 | 0.002 |
| 31074 | 0.001 |
| 31075 | 0.008 |
| 31076 | 0.017 |
| 31077 | 0.003 |
| 31078 | 0.002 |
| 31079 | 0.006 |
| 31080 | 0.007 |
| 31081 | 0.003 |
| 31082 | 0.004 |
| 31083 | 0.009 |
| 31084 | 0.003 |
| 31085 | 0.001 |
| 31086 | 0.003 |
| 31087 | 0.003 |
| 31088 | 0.003 |
| 31089 | 0.001 |
| 31090 | 0.005 |
| 31091 | 0.004 |
| 31092 | 0.002 |
| 31093 | 0.003 |
| 31094 | 0.006 |
| 31095 | 0.008 |
| 31096 | 0.007 |
| 31097 | 0.004 |
| 31098 | 0.003 |
| 31099 | 0.002 |
| 31100 | 0.002 |
| 31101 | 0.003 |
| 31102 | 0.002 |
| 31103 | 0.004 |
| 31104 | 0.003 |
| 31105 | 0.003 |
| 31106 | 0.004 |
| 31107 | 0.002 |
| 31108 | 0.005 |
| 31109 | 0.002 |
| 31110 | 0.004 |
| 31111 | 0.005 |
| 31112 | 0.005 |
| 31113 | 0.004 |
| 31114 | 0.003 |
| 31115 | 0.004 |
| 31116 | 0.006 |
| 31117 | 0.001 |
| 31118 | 0.006 |
| 31119 | 0.005 |
| 31120 | 0.008 |
| 31121 | 0.006 |
| 31122 | 0.004 |
| 31123 | 0.007 |
| 31124 | 0.005 |
| 31125 | 0.001 |
| 31126 | 0.002 |
| 31127 | 0.009 |
| 31128 | 0.008 |
| 31129 | 0.003 |
| 31130 | 0.002 |
| 31131 | 0.007 |
| 31132 | 0.004 |
| 31133 | 0.002 |
| 31134 | 0.002 |
| 31135 | 0.001 |
| 31136 | 0.007 |
| 31137 | 0.005 |
| 31138 | 0.006 |
| 31139 | 0.008 |
| 31140 | 0.006 |
| 31141 | 0.001 |
| 31142 | 0.003 |
| 31143 | 0.002 |
| 31144 | 0.003 |
| 31145 | 0.003 |
| 31146 | 0.002 |
| 31147 | 0.003 |
| 31148 | 0.002 |
| 31149 | 0.003 |
| 31150 | 0.003 |
| 31151 | 0.004 |
| 31152 | 0.009 |
| 31153 | 0.003 |
| 31154 | 0.003 |
| 31155 | 0.005 |
| 31156 | 0.01 |
| 31157 | 0.004 |
| 31158 | 0.005 |
| 31159 | 0.007 |
| 31160 | 0.003 |
| 31161 | 0.005 |
| 31162 | 0.003 |
| 31163 | 0.002 |
| 31164 | 0.007 |
| 31165 | 0.007 |
| 31166 | 0.003 |
| 31167 | 0.003 |
| 31168 | 0.005 |
| 31169 | 0.003 |
| 31170 | 0.003 |
| 31171 | 0.002 |
| 31172 | 0.002 |
| 31173 | 0.005 |
| 31174 | 0.005 |
| 31175 | 0.005 |
| 31176 | 0.002 |
| 31177 | 0.002 |
| 31178 | 0.005 |
| 31179 | 0.003 |
| 31180 | 0.002 |
| 31181 | 0.002 |
| 31182 | 0.003 |
| 31183 | 0.004 |
| 31184 | 0.004 |
| 31185 | 0.005 |
| 31186 | 0.002 |
| 31187 | 0.001 |
| 31188 | 0.005 |
| 31189 | 0.002 |
| 31190 | 0.006 |
| 31191 | 0.003 |
| 31192 | 0.005 |
| 31193 | 0.002 |
| 31194 | 0.006 |
| 31195 | 0.004 |
| 31196 | 0.007 |
| 31197 | 0.001 |
| 31198 | 0.004 |
| 31199 | 0.005 |
| 31200 | 0.009 |
| 31201 | 0.007 |
| 31202 | 0.003 |
| 31203 | 0.004 |
| 31204 | 0.003 |
| 31205 | 0.009 |
| 31206 | 0.002 |
| 31207 | 0.002 |
| 31208 | 0.002 |
| 31209 | 0.005 |
| 31210 | 0.002 |
| 31211 | 0.004 |
| 31212 | 0.001 |
| 31213 | 0.004 |
| 31214 | 0.004 |
| 31215 | 0.004 |
| 31216 | 0.003 |
| 31217 | 0.008 |
| 31218 | 0.004 |
| 31219 | 0.003 |
| 31220 | 0.004 |
| 31221 | 0.008 |
| 31222 | 0.009 |
| 31223 | 0.007 |
| 31224 | 0.003 |
| 31225 | 0.003 |
| 31226 | 0.004 |
| 31227 | 0.003 |
| 31228 | 0.001 |
| 31229 | 0.007 |
| 31230 | 0.009 |
| 31231 | 0.007 |
| 31232 | 0.006 |
| 31233 | 0.006 |
| 31234 | 0.003 |
| 31235 | 0.003 |
| 31236 | 0.004 |
| 31237 | 0.006 |
| 31238 | 0.002 |
| 31239 | 0.005 |
| 31240 | 0.009 |
| 31241 | 0.003 |
| 31242 | 0.005 |
| 31243 | 0.002 |
| 31244 | 0.002 |
| 31245 | 0.003 |
| 31246 | 0.004 |
| 31247 | 0.004 |
| 31248 | 0.003 |
| 31249 | 0.002 |
| 31250 | 0.007 |
| 31251 | 0.005 |
| 31252 | 0.004 |
| 31253 | 0.005 |
| 31254 | 0.003 |
| 31255 | 0.013 |
| 31256 | 0.006 |
| 31257 | 0.001 |
| 31258 | 0.005 |
| 31259 | 0.011 |
| 31260 | 0.004 |
| 31261 | 0.006 |
| 31262 | 0.004 |
| 31263 | 0.005 |
| 31264 | 0.005 |
| 31265 | 0.006 |
| 31266 | 0.006 |
| 31267 | 0.005 |
| 31268 | 0.009 |
| 31269 | 0.004 |
| 31270 | 0.007 |
| 31271 | 0.003 |
| 31272 | 0.003 |
| 31273 | 0.003 |
| 31274 | 0.003 |
| 31275 | 0.004 |
| 31276 | 0.004 |
| 31277 | 0.008 |
| 31278 | 0.007 |
| 31279 | 0.011 |
| 31280 | 0.009 |
| 31281 | 0.003 |
| 31282 | 0.004 |
| 31283 | 0.003 |
| 31284 | 0.008 |
| 31285 | 0.002 |
| 31286 | 0.003 |
| 31287 | 0.005 |
| 31288 | 0.007 |
| 31289 | 0.004 |
| 31290 | 0.002 |
| 31291 | 0.001 |
| 31292 | 0.003 |
| 31293 | 0.002 |
| 31294 | 0.001 |
| 31295 | 0.008 |
| 31296 | 0.004 |
| 31297 | 0.004 |
| 31298 | 0.003 |
| 31299 | 0.003 |
| 31300 | 0.004 |
| 31301 | 0.001 |
| 31302 | 0.001 |
| 31303 | 0.005 |
| 31304 | 0.002 |
| 31305 | 0.002 |
| 31306 | 0.003 |
| 31307 | 0.003 |
| 31308 | 0.002 |
| 31309 | 0.001 |
| 31310 | 0.002 |
| 31311 | 0.004 |
| 31312 | 0.005 |
| 31313 | 0.002 |
| 31314 | 0.006 |
| 31315 | 0.006 |
| 31316 | 0.002 |
| 31317 | 0.003 |
| 31318 | 0.002 |
| 31319 | 0.008 |
| 31320 | 0.005 |
| 31321 | 0.001 |
| 31322 | 0.003 |
| 31323 | 0.007 |
| 31324 | 0.002 |
| 31325 | 0.002 |
| 31326 | 0.005 |
| 31327 | 0.006 |
| 31328 | 0.004 |
| 31329 | 0.002 |
| 31330 | 0.002 |
| 31331 | 0.007 |
| 31332 | 0.005 |
| 31333 | 0.002 |
| 31334 | 0.002 |
| 31335 | 0.002 |
| 31336 | 0.001 |
| 31337 | 0.005 |
| 31338 | 0.003 |
| 31339 | 0.001 |
| 31340 | 0.007 |
| 31341 | 0.004 |
| 31342 | 0.002 |
| 31343 | 0.003 |
| 31344 | 0.004 |
| 31345 | 0.006 |
| 31346 | 0.003 |
| 31347 | 0.005 |
| 31348 | 0.002 |
| 31349 | 0.002 |
| 31350 | 0.003 |
| 31351 | 0.004 |
| 31352 | 0.002 |
| 31353 | 0.004 |
| 31354 | 0.005 |
| 31355 | 0.004 |
| 31356 | 0.006 |
| 31357 | 0.002 |
| 31358 | 0.004 |
| 31359 | 0.003 |
| 31360 | 0.003 |
| 31361 | 0.008 |
| 31362 | 0.002 |
| 31363 | 0.005 |
| 31364 | 0.008 |
| 31365 | 0.006 |
| 31366 | 0.005 |
| 31367 | 0.001 |
| 31368 | 0.002 |
| 31369 | 0.005 |
| 31370 | 0.006 |
| 31371 | 0.003 |
| 31372 | 0.002 |
| 31373 | 0.009 |
| 31374 | 0.002 |
| 31375 | 0.004 |
| 31376 | 0.007 |
| 31377 | 0.007 |
| 31378 | 0.003 |
| 31379 | 0.001 |
| 31380 | 0.008 |
| 31381 | 0.005 |
| 31382 | 0.002 |
| 31383 | 0.003 |
| 31384 | 0.006 |
| 31385 | 0.008 |
| 31386 | 0.002 |
| 31387 | 0.003 |
| 31388 | 0.006 |
| 31389 | 0.002 |
| 31390 | 0.002 |
| 31391 | 0.003 |
| 31392 | 0.002 |
| 31393 | 0.002 |
| 31394 | 0.005 |
| 31395 | 0.004 |
| 31396 | 0.004 |
| 31397 | 0.003 |
| 31398 | 0.003 |
| 31399 | 0.008 |
| 31400 | 0.012 |
| 31401 | 0.003 |
| 31402 | 0.005 |
| 31403 | 0.002 |
| 31404 | 0.005 |
| 31405 | 0.004 |
| 31406 | 0.004 |
| 31407 | 0.003 |
| 31408 | 0.004 |
| 31409 | 0.002 |
| 31410 | 0.007 |
| 31411 | 0.01 |
| 31412 | 0.009 |
| 31413 | 0.002 |
| 31414 | 0.001 |
| 31415 | 0.002 |
| 31416 | 0.006 |
| 31417 | 0.002 |
| 31418 | 0.003 |
| 31419 | 0.006 |
| 31420 | 0.002 |
| 31421 | 0.003 |
| 31422 | 0.003 |
| 31423 | 0.002 |
| 31424 | 0.003 |
| 31425 | 0.004 |
| 31426 | 0.005 |
| 31427 | 0.003 |
| 31428 | 0.004 |
| 31429 | 0.002 |
| 31430 | 0.002 |
| 31431 | 0.006 |
| 31432 | 0.007 |
| 31433 | 0.002 |
| 31434 | 0.002 |
| 31435 | 0.004 |
| 31436 | 0.009 |
| 31437 | 0.001 |
| 31438 | 0.002 |
| 31439 | 0.005 |
| 31440 | 0.005 |
| 31441 | 0.009 |
| 31442 | 0.002 |
| 31443 | 0.006 |
| 31444 | 0.009 |
| 31445 | 0.009 |
| 31446 | 0.003 |
| 31447 | 0.005 |
| 31448 | 0.004 |
| 31449 | 0.001 |
| 31450 | 0.003 |
| 31451 | 0.005 |
| 31452 | 0.005 |
| 31453 | 0.004 |
| 31454 | 0.007 |
| 31455 | 0.008 |
| 31456 | 0.004 |
| 31457 | 0.001 |
| 31458 | 0.004 |
| 31459 | 0.003 |
| 31460 | 0.002 |
| 31461 | 0.002 |
| 31462 | 0.001 |
| 31463 | 0.005 |
| 31464 | 0.007 |
| 31465 | 0.004 |
| 31466 | 0.004 |
| 31467 | 0.008 |
| 31468 | 0.004 |
| 31469 | 0.001 |
| 31470 | 0.002 |
| 31471 | 0.007 |
| 31472 | 0.006 |
| 31473 | 0.005 |
| 31474 | 0.003 |
| 31475 | 0.002 |
| 31476 | 0.003 |
| 31477 | 0.003 |
| 31478 | 0.006 |
| 31479 | 0.004 |
| 31480 | 0.003 |
| 31481 | 0.003 |
| 31482 | 0.003 |
| 31483 | 0.002 |
| 31484 | 0.004 |
| 31485 | 0.002 |
| 31486 | 0.003 |
| 31487 | 0.006 |
| 31488 | 0.003 |
| 31489 | 0.001 |
| 31490 | 0.003 |
| 31491 | 0.002 |
| 31492 | 0.002 |
| 31493 | 0.003 |
| 31494 | 0.002 |
| 31495 | 0.002 |
| 31496 | 0.005 |
| 31497 | 0.009 |
| 31498 | 0.003 |
| 31499 | 0.006 |
| 31500 | 0 |
| 31501 | 0.005 |
| 31502 | 0.006 |
| 31503 | 0.007 |
| 31504 | 0.002 |
| 31505 | 0.002 |
| 31506 | 0.003 |
| 31507 | 0.001 |
| 31508 | 0.003 |
| 31509 | 0.002 |
| 31510 | 0.002 |
| 31511 | 0.001 |
| 31512 | 0.005 |
| 31513 | 0.004 |
| 31514 | 0.002 |
| 31515 | 0.003 |
| 31516 | 0.002 |
| 31517 | 0.006 |
| 31518 | 0.003 |
| 31519 | 0.006 |
| 31520 | 0.01 |
| 31521 | 0.002 |
| 31522 | 0.002 |
| 31523 | 0.003 |
| 31524 | 0.012 |
| 31525 | 0.013 |
| 31526 | 0.008 |
| 31527 | 0.012 |
| 31528 | 0.006 |
| 31529 | 0.005 |
| 31530 | 0.006 |
| 31531 | 0.001 |
| 31532 | 0.002 |
| 31533 | 0.003 |
| 31534 | 0.004 |
| 31535 | 0.008 |
| 31536 | 0.005 |
| 31537 | 0.008 |
| 31538 | 0.008 |
| 31539 | 0.005 |
| 31540 | 0.004 |
| 31541 | 0.003 |
| 31542 | 0.006 |
| 31543 | 0.009 |
| 31544 | 0.004 |
| 31545 | 0.003 |
| 31546 | 0.004 |
| 31547 | 0.004 |
| 31548 | 0.005 |
| 31549 | 0.007 |
| 31550 | 0.009 |
| 31551 | 0.003 |
| 31552 | 0.003 |
| 31553 | 0.006 |
| 31554 | 0.004 |
| 31555 | 0.002 |
| 31556 | 0.005 |
| 31557 | 0.005 |
| 31558 | 0.005 |
| 31559 | 0.001 |
| 31560 | 0.003 |
| 31561 | 0.002 |
| 31562 | 0.004 |
| 31563 | 0.003 |
| 31564 | 0.003 |
| 31565 | 0.004 |
| 31566 | 0.003 |
| 31567 | 0.005 |
| 31568 | 0.001 |
| 31569 | 0.004 |
| 31570 | 0.004 |
| 31571 | 0.004 |
| 31572 | 0.007 |
| 31573 | 0.002 |
| 31574 | 0.003 |
| 31575 | 0.004 |
| 31576 | 0.002 |
| 31577 | 0.003 |
| 31578 | 0.009 |
| 31579 | 0.009 |
| 31580 | 0.008 |
| 31581 | 0.003 |
| 31582 | 0.001 |
| 31583 | 0.002 |
| 31584 | 0.002 |
| 31585 | 0.004 |
| 31586 | 0.003 |
| 31587 | 0.003 |
| 31588 | 0.004 |
| 31589 | 0.002 |
| 31590 | 0.002 |
| 31591 | 0.001 |
| 31592 | 0.006 |
| 31593 | 0.004 |
| 31594 | 0.004 |
| 31595 | 0.006 |
| 31596 | 0.003 |
| 31597 | 0.004 |
| 31598 | 0.002 |
| 31599 | 0.008 |
| 31600 | 0.004 |
| 31601 | 0.001 |
| 31602 | 0.003 |
| 31603 | 0.005 |
| 31604 | 0.003 |
| 31605 | 0.004 |
| 31606 | 0.005 |
| 31607 | 0.002 |
| 31608 | 0.002 |
| 31609 | 0.001 |
| 31610 | 0.001 |
| 31611 | 0.002 |
| 31612 | 0.009 |
| 31613 | 0.002 |
| 31614 | 0.003 |
| 31615 | 0.005 |
| 31616 | 0.002 |
| 31617 | 0.002 |
| 31618 | 0.003 |
| 31619 | 0.004 |
| 31620 | 0.005 |
| 31621 | 0.007 |
| 31622 | 0.005 |
| 31623 | 0.003 |
| 31624 | 0.001 |
| 31625 | 0.005 |
| 31626 | 0.001 |
| 31627 | 0.005 |
| 31628 | 0.01 |
| 31629 | 0.005 |
| 31630 | 0.003 |
| 31631 | 0.004 |
| 31632 | 0.003 |
| 31633 | 0.008 |
| 31634 | 0.002 |
| 31635 | 0.004 |
| 31636 | 0.01 |
| 31637 | 0.004 |
| 31638 | 0.003 |
| 31639 | 0.004 |
| 31640 | 0.005 |
| 31641 | 0.005 |
| 31642 | 0.004 |
| 31643 | 0.008 |
| 31644 | 0.006 |
| 31645 | 0.008 |
| 31646 | 0.003 |
| 31647 | 0.004 |
| 31648 | 0.003 |
| 31649 | 0.004 |
| 31650 | 0.002 |
| 31651 | 0.001 |
| 31652 | 0.002 |
| 31653 | 0.006 |
| 31654 | 0.002 |
| 31655 | 0.001 |
| 31656 | 0.003 |
| 31657 | 0.006 |
| 31658 | 0.004 |
| 31659 | 0.003 |
| 31660 | 0.006 |
| 31661 | 0.008 |
| 31662 | 0.004 |
| 31663 | 0.002 |
| 31664 | 0.004 |
| 31665 | 0.006 |
| 31666 | 0.002 |
| 31667 | 0.003 |
| 31668 | 0.003 |
| 31669 | 0.007 |
| 31670 | 0.002 |
| 31671 | 0.002 |
| 31672 | 0.002 |
| 31673 | 0.002 |
| 31674 | 0.003 |
| 31675 | 0.002 |
| 31676 | 0.01 |
| 31677 | 0.006 |
| 31678 | 0.003 |
| 31679 | 0.005 |
| 31680 | 0.004 |
| 31681 | 0.008 |
| 31682 | 0.003 |
| 31683 | 0.003 |
| 31684 | 0.002 |
| 31685 | 0.012 |
| 31686 | 0.002 |
| 31687 | 0.003 |
| 31688 | 0.003 |
| 31689 | 0.01 |
| 31690 | 0.004 |
| 31691 | 0.009 |
| 31692 | 0.006 |
| 31693 | 0.008 |
| 31694 | 0.002 |
| 31695 | 0.002 |
| 31696 | 0.006 |
| 31697 | 0.004 |
| 31698 | 0.008 |
| 31699 | 0.005 |
| 31700 | 0.002 |
| 31701 | 0.004 |
| 31702 | 0.002 |
| 31703 | 0.006 |
| 31704 | 0.001 |
| 31705 | 0.005 |
| 31706 | 0.005 |
| 31707 | 0.003 |
| 31708 | 0.004 |
| 31709 | 0.01 |
| 31710 | 0.002 |
| 31711 | 0.006 |
| 31712 | 0.004 |
| 31713 | 0.005 |
| 31714 | 0.006 |
| 31715 | 0.003 |
| 31716 | 0.012 |
| 31717 | 0.006 |
| 31718 | 0.004 |
| 31719 | 0.003 |
| 31720 | 0.004 |
| 31721 | 0.002 |
| 31722 | 0.003 |
| 31723 | 0.002 |
| 31724 | 0.003 |
| 31725 | 0.003 |
| 31726 | 0.002 |
| 31727 | 0.005 |
| 31728 | 0.009 |
| 31729 | 0.006 |
| 31730 | 0.002 |
| 31731 | 0.003 |
| 31732 | 0.009 |
| 31733 | 0.004 |
| 31734 | 0.004 |
| 31735 | 0.003 |
| 31736 | 0.004 |
| 31737 | 0.008 |
| 31738 | 0.005 |
| 31739 | 0.006 |
| 31740 | 0.004 |
| 31741 | 0.003 |
| 31742 | 0.006 |
| 31743 | 0.004 |
| 31744 | 0.007 |
| 31745 | 0.006 |
| 31746 | 0.001 |
| 31747 | 0.002 |
| 31748 | 0.002 |
| 31749 | 0.004 |
| 31750 | 0.003 |
| 31751 | 0.002 |
| 31752 | 0.005 |
| 31753 | 0.006 |
| 31754 | 0.002 |
| 31755 | 0.002 |
| 31756 | 0.003 |
| 31757 | 0.005 |
| 31758 | 0.004 |
| 31759 | 0.003 |
| 31760 | 0.004 |
| 31761 | 0.002 |
| 31762 | 0.005 |
| 31763 | 0.004 |
| 31764 | 0.002 |
| 31765 | 0.004 |
| 31766 | 0.002 |
| 31767 | 0.007 |
| 31768 | 0.009 |
| 31769 | 0.006 |
| 31770 | 0.002 |
| 31771 | 0.002 |
| 31772 | 0.003 |
| 31773 | 0.005 |
| 31774 | 0.003 |
| 31775 | 0.002 |
| 31776 | 0.002 |
| 31777 | 0.001 |
| 31778 | 0.003 |
| 31779 | 0.004 |
| 31780 | 0.005 |
| 31781 | 0.007 |
| 31782 | 0.003 |
| 31783 | 0.001 |
| 31784 | 0.005 |
| 31785 | 0.008 |
| 31786 | 0.003 |
| 31787 | 0.003 |
| 31788 | 0.004 |
| 31789 | 0.004 |
| 31790 | 0.002 |
| 31791 | 0.004 |
| 31792 | 0.001 |
| 31793 | 0.003 |
| 31794 | 0.008 |
| 31795 | 0.002 |
| 31796 | 0.004 |
| 31797 | 0.006 |
| 31798 | 0.008 |
| 31799 | 0.008 |
| 31800 | 0.006 |
| 31801 | 0.003 |
| 31802 | 0.004 |
| 31803 | 0.003 |
| 31804 | 0.002 |
| 31805 | 0.004 |
| 31806 | 0.009 |
| 31807 | 0.006 |
| 31808 | 0.002 |
| 31809 | 0.002 |
| 31810 | 0.003 |
| 31811 | 0.002 |
| 31812 | 0.003 |
| 31813 | 0.001 |
| 31814 | 0.002 |
| 31815 | 0.001 |
| 31816 | 0.003 |
| 31817 | 0.004 |
| 31818 | 0.004 |
| 31819 | 0.001 |
| 31820 | 0.001 |
| 31821 | 0.001 |
| 31822 | 0.002 |
| 31823 | 0.003 |
| 31824 | 0.002 |
| 31825 | 0.001 |
| 31826 | 0.004 |
| 31827 | 0.004 |
| 31828 | 0.004 |
| 31829 | 0.009 |
| 31830 | 0.002 |
| 31831 | 0.005 |
| 31832 | 0.003 |
| 31833 | 0.005 |
| 31834 | 0.006 |
| 31835 | 0.005 |
| 31836 | 0.003 |
| 31837 | 0.006 |
| 31838 | 0.005 |
| 31839 | 0.003 |
| 31840 | 0.003 |
| 31841 | 0.002 |
| 31842 | 0.003 |
| 31843 | 0.003 |
| 31844 | 0.007 |
| 31845 | 0.002 |
| 31846 | 0.008 |
| 31847 | 0.003 |
| 31848 | 0.003 |
| 31849 | 0.003 |
| 31850 | 0.003 |
| 31851 | 0.003 |
| 31852 | 0.004 |
| 31853 | 0.006 |
| 31854 | 0.003 |
| 31855 | 0.003 |
| 31856 | 0.003 |
| 31857 | 0.002 |
| 31858 | 0.006 |
| 31859 | 0.004 |
| 31860 | 0.005 |
| 31861 | 0.003 |
| 31862 | 0.004 |
| 31863 | 0.008 |
| 31864 | 0.004 |
| 31865 | 0.002 |
| 31866 | 0.004 |
| 31867 | 0.006 |
| 31868 | 0.007 |
| 31869 | 0.001 |
| 31870 | 0.006 |
| 31871 | 0.002 |
| 31872 | 0.002 |
| 31873 | 0.004 |
| 31874 | 0.002 |
| 31875 | 0.002 |
| 31876 | 0.006 |
| 31877 | 0.002 |
| 31878 | 0.001 |
| 31879 | 0.003 |
| 31880 | 0.007 |
| 31881 | 0.002 |
| 31882 | 0.002 |
| 31883 | 0.002 |
| 31884 | 0.005 |
| 31885 | 0.007 |
| 31886 | 0.003 |
| 31887 | 0.005 |
| 31888 | 0.004 |
| 31889 | 0.004 |
| 31890 | 0.001 |
| 31891 | 0.006 |
| 31892 | 0.005 |
| 31893 | 0.005 |
| 31894 | 0.001 |
| 31895 | 0.002 |
| 31896 | 0.001 |
| 31897 | 0.004 |
| 31898 | 0.005 |
| 31899 | 0.004 |
| 31900 | 0.003 |
| 31901 | 0.003 |
| 31902 | 0.002 |
| 31903 | 0.001 |
| 31904 | 0.004 |
| 31905 | 0.005 |
| 31906 | 0.004 |
| 31907 | 0.007 |
| 31908 | 0.005 |
| 31909 | 0.001 |
| 31910 | 0.002 |
| 31911 | 0.006 |
| 31912 | 0.002 |
| 31913 | 0.002 |
| 31914 | 0.002 |
| 31915 | 0.004 |
| 31916 | 0.004 |
| 31917 | 0.003 |
| 31918 | 0.003 |
| 31919 | 0.003 |
| 31920 | 0.003 |
| 31921 | 0.005 |
| 31922 | 0.002 |
| 31923 | 0.001 |
| 31924 | 0.002 |
| 31925 | 0.001 |
| 31926 | 0.006 |
| 31927 | 0.007 |
| 31928 | 0.007 |
| 31929 | 0.003 |
| 31930 | 0.003 |
| 31931 | 0.004 |
| 31932 | 0.005 |
| 31933 | 0.002 |
| 31934 | 0.002 |
| 31935 | 0.004 |
| 31936 | 0.004 |
| 31937 | 0.004 |
| 31938 | 0.004 |
| 31939 | 0.005 |
| 31940 | 0.007 |
| 31941 | 0.004 |
| 31942 | 0.002 |
| 31943 | 0.004 |
| 31944 | 0.004 |
| 31945 | 0.003 |
| 31946 | 0.004 |
| 31947 | 0.004 |
| 31948 | 0.004 |
| 31949 | 0.004 |
| 31950 | 0.007 |
| 31951 | 0.008 |
| 31952 | 0.005 |
| 31953 | 0.003 |
| 31954 | 0.004 |
| 31955 | 0.003 |
| 31956 | 0.004 |
| 31957 | 0.002 |
| 31958 | 0.002 |
| 31959 | 0.007 |
| 31960 | 0.001 |
| 31961 | 0 |
| 31962 | 0 |
| 31963 | 0.002 |
| 31964 | 0.003 |
| 31965 | 0.006 |
| 31966 | 0.007 |
| 31967 | 0.003 |
| 31968 | 0.003 |
| 31969 | 0.001 |
| 31970 | 0.003 |
| 31971 | 0.005 |
| 31972 | 0.001 |
| 31973 | 0.001 |
| 31974 | 0.005 |
| 31975 | 0.006 |
| 31976 | 0.003 |
| 31977 | 0.007 |
| 31978 | 0.004 |
| 31979 | 0.01 |
| 31980 | 0.007 |
| 31981 | 0.002 |
| 31982 | 0.003 |
| 31983 | 0.009 |
| 31984 | 0.011 |
| 31985 | 0.006 |
| 31986 | 0.003 |
| 31987 | 0.002 |
| 31988 | 0.002 |
| 31989 | 0.002 |
| 31990 | 0.004 |
| 31991 | 0.003 |
| 31992 | 0.002 |
| 31993 | 0.004 |
| 31994 | 0.004 |
| 31995 | 0.007 |
| 31996 | 0.007 |
| 31997 | 0.004 |
| 31998 | 0.006 |
| 31999 | 0.004 |
| 32000 | 0.001 |
| 32001 | 0.002 |
| 32002 | 0.002 |
| 32003 | 0.002 |
| 32004 | 0.004 |
| 32005 | 0.003 |
| 32006 | 0.003 |
| 32007 | 0.004 |
| 32008 | 0.004 |
| 32009 | 0.002 |
| 32010 | 0.002 |
| 32011 | 0.006 |
| 32012 | 0.014 |
| 32013 | 0.003 |
| 32014 | 0.002 |
| 32015 | 0.003 |
| 32016 | 0.007 |
| 32017 | 0.004 |
| 32018 | 0.003 |
| 32019 | 0.003 |
| 32020 | 0.007 |
| 32021 | 0.004 |
| 32022 | 0.004 |
| 32023 | 0.003 |
| 32024 | 0.003 |
| 32025 | 0.003 |
| 32026 | 0.005 |
| 32027 | 0.004 |
| 32028 | 0.005 |
| 32029 | 0.005 |
| 32030 | 0.004 |
| 32031 | 0.003 |
| 32032 | 0.004 |
| 32033 | 0.004 |
| 32034 | 0.002 |
| 32035 | 0.003 |
| 32036 | 0.006 |
| 32037 | 0.002 |
| 32038 | 0.003 |
| 32039 | 0.003 |
| 32040 | 0.004 |
| 32041 | 0.004 |
| 32042 | 0.005 |
| 32043 | 0.004 |
| 32044 | 0.003 |
| 32045 | 0.001 |
| 32046 | 0.002 |
| 32047 | 0.003 |
| 32048 | 0.002 |
| 32049 | 0.002 |
| 32050 | 0.003 |
| 32051 | 0.004 |
| 32052 | 0.001 |
| 32053 | 0.004 |
| 32054 | 0.002 |
| 32055 | 0.005 |
| 32056 | 0.005 |
| 32057 | 0.004 |
| 32058 | 0.002 |
| 32059 | 0.004 |
| 32060 | 0.005 |
| 32061 | 0.002 |
| 32062 | 0.005 |
| 32063 | 0.005 |
| 32064 | 0.006 |
| 32065 | 0.002 |
| 32066 | 0.006 |
| 32067 | 0.006 |
| 32068 | 0.006 |
| 32069 | 0.004 |
| 32070 | 0.004 |
| 32071 | 0.003 |
| 32072 | 0.002 |
| 32073 | 0.004 |
| 32074 | 0.002 |
| 32075 | 0.005 |
| 32076 | 0.002 |
| 32077 | 0.003 |
| 32078 | 0.008 |
| 32079 | 0.01 |
| 32080 | 0.006 |
| 32081 | 0.002 |
| 32082 | 0.004 |
| 32083 | 0.005 |
| 32084 | 0.002 |
| 32085 | 0.003 |
| 32086 | 0.002 |
| 32087 | 0.003 |
| 32088 | 0.006 |
| 32089 | 0.002 |
| 32090 | 0.003 |
| 32091 | 0.002 |
| 32092 | 0.004 |
| 32093 | 0.002 |
| 32094 | 0.003 |
| 32095 | 0.004 |
| 32096 | 0.006 |
| 32097 | 0.007 |
| 32098 | 0.002 |
| 32099 | 0.003 |
| 32100 | 0.008 |
| 32101 | 0.007 |
| 32102 | 0.002 |
| 32103 | 0.003 |
| 32104 | 0.003 |
| 32105 | 0.005 |
| 32106 | 0.003 |
| 32107 | 0.004 |
| 32108 | 0.007 |
| 32109 | 0.004 |
| 32110 | 0.007 |
| 32111 | 0.004 |
| 32112 | 0.006 |
| 32113 | 0.003 |
| 32114 | 0.003 |
| 32115 | 0.001 |
| 32116 | 0.001 |
| 32117 | 0.005 |
| 32118 | 0.001 |
| 32119 | 0.003 |
| 32120 | 0.003 |
| 32121 | 0.001 |
| 32122 | 0.002 |
| 32123 | 0.003 |
| 32124 | 0.006 |
| 32125 | 0.002 |
| 32126 | 0.003 |
| 32127 | 0.003 |
| 32128 | 0.003 |
| 32129 | 0.002 |
| 32130 | 0.008 |
| 32131 | 0.002 |
| 32132 | 0.004 |
| 32133 | 0.006 |
| 32134 | 0.005 |
| 32135 | 0.005 |
| 32136 | 0.006 |
| 32137 | 0.006 |
| 32138 | 0.008 |
| 32139 | 0.008 |
| 32140 | 0.005 |
| 32141 | 0.006 |
| 32142 | 0.005 |
| 32143 | 0.008 |
| 32144 | 0.006 |
| 32145 | 0.009 |
| 32146 | 0.008 |
| 32147 | 0.004 |
| 32148 | 0.006 |
| 32149 | 0.009 |
| 32150 | 0.003 |
| 32151 | 0.005 |
| 32152 | 0.007 |
| 32153 | 0.008 |
| 32154 | 0.002 |
| 32155 | 0.004 |
| 32156 | 0.007 |
| 32157 | 0.006 |
| 32158 | 0.005 |
| 32159 | 0.009 |
| 32160 | 0.002 |
| 32161 | 0.004 |
| 32162 | 0.006 |
| 32163 | 0.006 |
| 32164 | 0.006 |
| 32165 | 0.002 |
| 32166 | 0.002 |
| 32167 | 0.001 |
| 32168 | 0.005 |
| 32169 | 0.001 |
| 32170 | 0.002 |
| 32171 | 0.003 |
| 32172 | 0.006 |
| 32173 | 0.004 |
| 32174 | 0.007 |
| 32175 | 0.001 |
| 32176 | 0.004 |
| 32177 | 0.003 |
| 32178 | 0.005 |
| 32179 | 0.009 |
| 32180 | 0.004 |
| 32181 | 0.004 |
| 32182 | 0.003 |
| 32183 | 0.003 |
| 32184 | 0.003 |
| 32185 | 0.004 |
| 32186 | 0.007 |
| 32187 | 0.001 |
| 32188 | 0.004 |
| 32189 | 0.003 |
| 32190 | 0.002 |
| 32191 | 0.007 |
| 32192 | 0.004 |
| 32193 | 0.006 |
| 32194 | 0.002 |
| 32195 | 0.005 |
| 32196 | 0.006 |
| 32197 | 0.008 |
| 32198 | 0.004 |
| 32199 | 0.004 |
| 32200 | 0.003 |
| 32201 | 0.004 |
| 32202 | 0.002 |
| 32203 | 0.002 |
| 32204 | 0.007 |
| 32205 | 0.006 |
| 32206 | 0.001 |
| 32207 | 0.007 |
| 32208 | 0.005 |
| 32209 | 0.007 |
| 32210 | 0.002 |
| 32211 | 0.005 |
| 32212 | 0.005 |
| 32213 | 0.004 |
| 32214 | 0.002 |
| 32215 | 0.001 |
| 32216 | 0.004 |
| 32217 | 0.002 |
| 32218 | 0.002 |
| 32219 | 0.002 |
| 32220 | 0.004 |
| 32221 | 0.007 |
| 32222 | 0.003 |
| 32223 | 0.002 |
| 32224 | 0.002 |
| 32225 | 0.003 |
| 32226 | 0.003 |
| 32227 | 0.004 |
| 32228 | 0.002 |
| 32229 | 0.002 |
| 32230 | 0.003 |
| 32231 | 0.006 |
| 32232 | 0.011 |
| 32233 | 0.004 |
| 32234 | 0.004 |
| 32235 | 0.004 |
| 32236 | 0.002 |
| 32237 | 0.003 |
| 32238 | 0.004 |
| 32239 | 0.003 |
| 32240 | 0.002 |
| 32241 | 0.001 |
| 32242 | 0.004 |
| 32243 | 0.003 |
| 32244 | 0.006 |
| 32245 | 0.003 |
| 32246 | 0.004 |
| 32247 | 0.004 |
| 32248 | 0.004 |
| 32249 | 0.002 |
| 32250 | 0.003 |
| 32251 | 0.002 |
| 32252 | 0.005 |
| 32253 | 0.004 |
| 32254 | 0.001 |
| 32255 | 0.005 |
| 32256 | 0.008 |
| 32257 | 0.004 |
| 32258 | 0.002 |
| 32259 | 0.002 |
| 32260 | 0.007 |
| 32261 | 0.002 |
| 32262 | 0.004 |
| 32263 | 0.001 |
| 32264 | 0.003 |
| 32265 | 0.003 |
| 32266 | 0.002 |
| 32267 | 0.005 |
| 32268 | 0.003 |
| 32269 | 0.002 |
| 32270 | 0.002 |
| 32271 | 0.007 |
| 32272 | 0.008 |
| 32273 | 0.002 |
| 32274 | 0.001 |
| 32275 | 0.005 |
| 32276 | 0.003 |
| 32277 | 0.002 |
| 32278 | 0.002 |
| 32279 | 0.003 |
| 32280 | 0.004 |
| 32281 | 0.002 |
| 32282 | 0.002 |
| 32283 | 0.001 |
| 32284 | 0.005 |
| 32285 | 0.003 |
| 32286 | 0.001 |
| 32287 | 0.004 |
| 32288 | 0.01 |
| 32289 | 0.003 |
| 32290 | 0.004 |
| 32291 | 0.004 |
| 32292 | 0.006 |
| 32293 | 0.004 |
| 32294 | 0.004 |
| 32295 | 0.002 |
| 32296 | 0.001 |
| 32297 | 0.007 |
| 32298 | 0.003 |
| 32299 | 0.005 |
| 32300 | 0.005 |
| 32301 | 0.003 |
| 32302 | 0.003 |
| 32303 | 0.001 |
| 32304 | 0.002 |
| 32305 | 0.007 |
| 32306 | 0.002 |
| 32307 | 0.006 |
| 32308 | 0.002 |
| 32309 | 0.007 |
| 32310 | 0.001 |
| 32311 | 0.007 |
| 32312 | 0.006 |
| 32313 | 0.004 |
| 32314 | 0.003 |
| 32315 | 0.004 |
| 32316 | 0.004 |
| 32317 | 0.004 |
| 32318 | 0.004 |
| 32319 | 0.004 |
| 32320 | 0.004 |
| 32321 | 0.002 |
| 32322 | 0.003 |
| 32323 | 0.002 |
| 32324 | 0.004 |
| 32325 | 0.003 |
| 32326 | 0.001 |
| 32327 | 0.002 |
| 32328 | 0.007 |
| 32329 | 0.007 |
| 32330 | 0.003 |
| 32331 | 0.003 |
| 32332 | 0.001 |
| 32333 | 0.002 |
| 32334 | 0.001 |
| 32335 | 0.002 |
| 32336 | 0.003 |
| 32337 | 0 |
| 32338 | 0.001 |
| 32339 | 0.002 |
| 32340 | 0.004 |
| 32341 | 0.009 |
| 32342 | 0.003 |
| 32343 | 0.002 |
| 32344 | 0.003 |
| 32345 | 0.004 |
| 32346 | 0.001 |
| 32347 | 0.003 |
| 32348 | 0.003 |
| 32349 | 0.004 |
| 32350 | 0.003 |
| 32351 | 0.007 |
| 32352 | 0.006 |
| 32353 | 0.001 |
| 32354 | 0.003 |
| 32355 | 0.004 |
| 32356 | 0.005 |
| 32357 | 0.005 |
| 32358 | 0.004 |
| 32359 | 0.005 |
| 32360 | 0.006 |
| 32361 | 0.003 |
| 32362 | 0.003 |
| 32363 | 0.004 |
| 32364 | 0.004 |
| 32365 | 0.008 |
| 32366 | 0.005 |
| 32367 | 0.003 |
| 32368 | 0.002 |
| 32369 | 0.007 |
| 32370 | 0.002 |
| 32371 | 0.003 |
| 32372 | 0.001 |
| 32373 | 0.005 |
| 32374 | 0.001 |
| 32375 | 0.004 |
| 32376 | 0.005 |
| 32377 | 0.005 |
| 32378 | 0.002 |
| 32379 | 0.001 |
| 32380 | 0.005 |
| 32381 | 0.004 |
| 32382 | 0.007 |
| 32383 | 0.001 |
| 32384 | 0.008 |
| 32385 | 0.004 |
| 32386 | 0.002 |
| 32387 | 0.001 |
| 32388 | 0.003 |
| 32389 | 0.004 |
| 32390 | 0.001 |
| 32391 | 0.005 |
| 32392 | 0.005 |
| 32393 | 0.011 |
| 32394 | 0.007 |
| 32395 | 0.005 |
| 32396 | 0.002 |
| 32397 | 0.004 |
| 32398 | 0.002 |
| 32399 | 0.005 |
| 32400 | 0.006 |
| 32401 | 0.005 |
| 32402 | 0.001 |
| 32403 | 0.003 |
| 32404 | 0.003 |
| 32405 | 0.009 |
| 32406 | 0.008 |
| 32407 | 0.004 |
| 32408 | 0.006 |
| 32409 | 0.003 |
| 32410 | 0.008 |
| 32411 | 0.003 |
| 32412 | 0.008 |
| 32413 | 0.003 |
| 32414 | 0.002 |
| 32415 | 0.001 |
| 32416 | 0.004 |
| 32417 | 0.003 |
| 32418 | 0.002 |
| 32419 | 0.004 |
| 32420 | 0.004 |
| 32421 | 0.005 |
| 32422 | 0.006 |
| 32423 | 0.006 |
| 32424 | 0.008 |
| 32425 | 0.005 |
| 32426 | 0.004 |
| 32427 | 0.005 |
| 32428 | 0.002 |
| 32429 | 0.003 |
| 32430 | 0.004 |
| 32431 | 0.004 |
| 32432 | 0.003 |
| 32433 | 0.004 |
| 32434 | 0.003 |
| 32435 | 0.004 |
| 32436 | 0.007 |
| 32437 | 0.006 |
| 32438 | 0.003 |
| 32439 | 0.004 |
| 32440 | 0.004 |
| 32441 | 0.006 |
| 32442 | 0.003 |
| 32443 | 0.001 |
| 32444 | 0.002 |
| 32445 | 0.002 |
| 32446 | 0.003 |
| 32447 | 0.001 |
| 32448 | 0.005 |
| 32449 | 0.003 |
| 32450 | 0.008 |
| 32451 | 0.008 |
| 32452 | 0.009 |
| 32453 | 0.002 |
| 32454 | 0.004 |
| 32455 | 0.006 |
| 32456 | 0.006 |
| 32457 | 0.002 |
| 32458 | 0.003 |
| 32459 | 0.006 |
| 32460 | 0.008 |
| 32461 | 0.003 |
| 32462 | 0.003 |
| 32463 | 0.003 |
| 32464 | 0.003 |
| 32465 | 0.003 |
| 32466 | 0.002 |
| 32467 | 0.006 |
| 32468 | 0.005 |
| 32469 | 0.003 |
| 32470 | 0.001 |
| 32471 | 0.002 |
| 32472 | 0.003 |
| 32473 | 0.002 |
| 32474 | 0.001 |
| 32475 | 0.003 |
| 32476 | 0.007 |
| 32477 | 0.007 |
| 32478 | 0.004 |
| 32479 | 0.004 |
| 32480 | 0.008 |
| 32481 | 0.001 |
| 32482 | 0.004 |
| 32483 | 0.005 |
| 32484 | 0.004 |
| 32485 | 0.003 |
| 32486 | 0.004 |
| 32487 | 0.006 |
| 32488 | 0.006 |
| 32489 | 0.005 |
| 32490 | 0.004 |
| 32491 | 0.002 |
| 32492 | 0.01 |
| 32493 | 0.013 |
| 32494 | 0.004 |
| 32495 | 0.004 |
| 32496 | 0.008 |
| 32497 | 0.005 |
| 32498 | 0.002 |
| 32499 | 0.003 |
| 32500 | 0.002 |
| 32501 | 0.004 |
| 32502 | 0.005 |
| 32503 | 0.006 |
| 32504 | 0.003 |
| 32505 | 0.003 |
| 32506 | 0.004 |
| 32507 | 0.005 |
| 32508 | 0.004 |
| 32509 | 0.004 |
| 32510 | 0.004 |
| 32511 | 0.003 |
| 32512 | 0.005 |
| 32513 | 0.003 |
| 32514 | 0.003 |
| 32515 | 0.003 |
| 32516 | 0.004 |
| 32517 | 0.003 |
| 32518 | 0.002 |
| 32519 | 0.008 |
| 32520 | 0.008 |
| 32521 | 0.003 |
| 32522 | 0.003 |
| 32523 | 0.005 |
| 32524 | 0.005 |
| 32525 | 0.002 |
| 32526 | 0.004 |
| 32527 | 0.002 |
| 32528 | 0.001 |
| 32529 | 0.005 |
| 32530 | 0.004 |
| 32531 | 0.005 |
| 32532 | 0.005 |
| 32533 | 0.007 |
| 32534 | 0.004 |
| 32535 | 0.003 |
| 32536 | 0.005 |
| 32537 | 0.005 |
| 32538 | 0.004 |
| 32539 | 0.007 |
| 32540 | 0.005 |
| 32541 | 0.003 |
| 32542 | 0.002 |
| 32543 | 0.003 |
| 32544 | 0.007 |
| 32545 | 0.003 |
| 32546 | 0.004 |
| 32547 | 0.007 |
| 32548 | 0.005 |
| 32549 | 0.003 |
| 32550 | 0.005 |
| 32551 | 0.007 |
| 32552 | 0.009 |
| 32553 | 0.001 |
| 32554 | 0.005 |
| 32555 | 0.004 |
| 32556 | 0.007 |
| 32557 | 0.003 |
| 32558 | 0.003 |
| 32559 | 0.003 |
| 32560 | 0.005 |
| 32561 | 0.002 |
| 32562 | 0.011 |
| 32563 | 0.006 |
| 32564 | 0.003 |
| 32565 | 0.007 |
| 32566 | 0.004 |
| 32567 | 0.003 |
| 32568 | 0.004 |
| 32569 | 0.002 |
| 32570 | 0.001 |
| 32571 | 0.002 |
| 32572 | 0.006 |
| 32573 | 0.003 |
| 32574 | 0.003 |
| 32575 | 0.001 |
| 32576 | 0.009 |
| 32577 | 0.002 |
| 32578 | 0.001 |
| 32579 | 0.008 |
| 32580 | 0.007 |
| 32581 | 0.004 |
| 32582 | 0.004 |
| 32583 | 0.005 |
| 32584 | 0.003 |
| 32585 | 0.003 |
| 32586 | 0.003 |
| 32587 | 0.002 |
| 32588 | 0.005 |
| 32589 | 0.006 |
| 32590 | 0.002 |
| 32591 | 0.004 |
| 32592 | 0.004 |
| 32593 | 0.002 |
| 32594 | 0.002 |
| 32595 | 0.004 |
| 32596 | 0.003 |
| 32597 | 0.003 |
| 32598 | 0.004 |
| 32599 | 0.007 |
| 32600 | 0.001 |
| 32601 | 0.003 |
| 32602 | 0.005 |
| 32603 | 0.002 |
| 32604 | 0.005 |
| 32605 | 0.005 |
| 32606 | 0.008 |
| 32607 | 0.007 |
| 32608 | 0.006 |
| 32609 | 0 |
| 32610 | 0.003 |
| 32611 | 0.003 |
| 32612 | 0.004 |
| 32613 | 0.001 |
| 32614 | 0.002 |
| 32615 | 0.003 |
| 32616 | 0.01 |
| 32617 | 0.002 |
| 32618 | 0.002 |
| 32619 | 0.008 |
| 32620 | 0.006 |
| 32621 | 0.002 |
| 32622 | 0.003 |
| 32623 | 0.008 |
| 32624 | 0.012 |
| 32625 | 0.007 |
| 32626 | 0.002 |
| 32627 | 0.002 |
| 32628 | 0.009 |
| 32629 | 0.009 |
| 32630 | 0.002 |
| 32631 | 0.002 |
| 32632 | 0.004 |
| 32633 | 0.003 |
| 32634 | 0.002 |
| 32635 | 0.003 |
| 32636 | 0.004 |
| 32637 | 0.002 |
| 32638 | 0.001 |
| 32639 | 0.001 |
| 32640 | 0.002 |
| 32641 | 0.01 |
| 32642 | 0.002 |
| 32643 | 0.004 |
| 32644 | 0.006 |
| 32645 | 0.007 |
| 32646 | 0.006 |
| 32647 | 0.003 |
| 32648 | 0.003 |
| 32649 | 0.005 |
| 32650 | 0.004 |
| 32651 | 0.002 |
| 32652 | 0.004 |
| 32653 | 0.006 |
| 32654 | 0.003 |
| 32655 | 0.005 |
| 32656 | 0.004 |
| 32657 | 0.009 |
| 32658 | 0.003 |
| 32659 | 0.005 |
| 32660 | 0.006 |
| 32661 | 0.004 |
| 32662 | 0.003 |
| 32663 | 0.006 |
| 32664 | 0.007 |
| 32665 | 0.007 |
| 32666 | 0.002 |
| 32667 | 0.007 |
| 32668 | 0.009 |
| 32669 | 0.005 |
| 32670 | 0.003 |
| 32671 | 0.002 |
| 32672 | 0.004 |
| 32673 | 0.01 |
| 32674 | 0.002 |
| 32675 | 0.004 |
| 32676 | 0.009 |
| 32677 | 0.007 |
| 32678 | 0 |
| 32679 | 0.003 |
| 32680 | 0.005 |
| 32681 | 0.008 |
| 32682 | 0.004 |
| 32683 | 0.003 |
| 32684 | 0.004 |
| 32685 | 0.001 |
| 32686 | 0.003 |
| 32687 | 0.004 |
| 32688 | 0.005 |
| 32689 | 0.002 |
| 32690 | 0.003 |
| 32691 | 0.006 |
| 32692 | 0.006 |
| 32693 | 0.001 |
| 32694 | 0.002 |
| 32695 | 0.008 |
| 32696 | 0.008 |
| 32697 | 0.004 |
| 32698 | 0.002 |
| 32699 | 0.003 |
| 32700 | 0.009 |
| 32701 | 0.003 |
| 32702 | 0.004 |
| 32703 | 0.007 |
| 32704 | 0.007 |
| 32705 | 0.005 |
| 32706 | 0.005 |
| 32707 | 0.009 |
| 32708 | 0.005 |
| 32709 | 0.003 |
| 32710 | 0.005 |
| 32711 | 0.004 |
| 32712 | 0.007 |
| 32713 | 0.004 |
| 32714 | 0.002 |
| 32715 | 0.004 |
| 32716 | 0.003 |
| 32717 | 0.002 |
| 32718 | 0.002 |
| 32719 | 0.005 |
| 32720 | 0.003 |
| 32721 | 0.006 |
| 32722 | 0.002 |
| 32723 | 0.007 |
| 32724 | 0.006 |
| 32725 | 0.01 |
| 32726 | 0.005 |
| 32727 | 0.005 |
| 32728 | 0.004 |
| 32729 | 0.004 |
| 32730 | 0.003 |
| 32731 | 0.006 |
| 32732 | 0.008 |
| 32733 | 0.002 |
| 32734 | 0.003 |
| 32735 | 0.003 |
| 32736 | 0.001 |
| 32737 | 0.003 |
| 32738 | 0.007 |
| 32739 | 0.001 |
| 32740 | 0.011 |
| 32741 | 0.003 |
| 32742 | 0.004 |
| 32743 | 0.002 |
| 32744 | 0.002 |
| 32745 | 0.005 |
| 32746 | 0.003 |
| 32747 | 0.003 |
| 32748 | 0.005 |
| 32749 | 0.005 |
| 32750 | 0.002 |
| 32751 | 0.005 |
| 32752 | 0.006 |
| 32753 | 0.005 |
| 32754 | 0.007 |
| 32755 | 0.007 |
| 32756 | 0.001 |
| 32757 | 0.002 |
| 32758 | 0.002 |
| 32759 | 0.004 |
| 32760 | 0.002 |
| 32761 | 0.001 |
| 32762 | 0.011 |
| 32763 | 0.011 |
| 32764 | 0.005 |
| 32765 | 0.002 |
| 32766 | 0.004 |
| 32767 | 0.007 |
| 32768 | 0.006 |
| 32769 | 0.005 |
| 32770 | 0.004 |
| 32771 | 0.005 |
| 32772 | 0.005 |
| 32773 | 0.003 |
| 32774 | 0.005 |
| 32775 | 0.006 |
| 32776 | 0.01 |
| 32777 | 0.006 |
| 32778 | 0.005 |
| 32779 | 0.007 |
| 32780 | 0.003 |
| 32781 | 0.003 |
| 32782 | 0.008 |
| 32783 | 0.008 |
| 32784 | 0.009 |
| 32785 | 0.005 |
| 32786 | 0.002 |
| 32787 | 0.008 |
| 32788 | 0.008 |
| 32789 | 0.004 |
| 32790 | 0.003 |
| 32791 | 0.003 |
| 32792 | 0.009 |
| 32793 | 0.006 |
| 32794 | 0.001 |
| 32795 | 0.003 |
| 32796 | 0.005 |
| 32797 | 0.008 |
| 32798 | 0.001 |
| 32799 | 0.005 |
| 32800 | 0.01 |
| 32801 | 0.006 |
| 32802 | 0.005 |
| 32803 | 0.005 |
| 32804 | 0.003 |
| 32805 | 0.003 |
| 32806 | 0.006 |
| 32807 | 0.009 |
| 32808 | 0.007 |
| 32809 | 0.004 |
| 32810 | 0.004 |
| 32811 | 0.007 |
| 32812 | 0.004 |
| 32813 | 0.004 |
| 32814 | 0.005 |
| 32815 | 0.002 |
| 32816 | 0.005 |
| 32817 | 0.003 |
| 32818 | 0.003 |
| 32819 | 0.002 |
| 32820 | 0.004 |
| 32821 | 0.002 |
| 32822 | 0.006 |
| 32823 | 0.005 |
| 32824 | 0.003 |
| 32825 | 0.003 |
| 32826 | 0.002 |
| 32827 | 0.004 |
| 32828 | 0.002 |
| 32829 | 0.004 |
| 32830 | 0.003 |
| 32831 | 0.002 |
| 32832 | 0.004 |
| 32833 | 0.004 |
| 32834 | 0.005 |
| 32835 | 0.006 |
| 32836 | 0.006 |
| 32837 | 0.007 |
| 32838 | 0.002 |
| 32839 | 0.002 |
| 32840 | 0.005 |
| 32841 | 0.005 |
| 32842 | 0 |
| 32843 | 0.007 |
| 32844 | 0.008 |
| 32845 | 0.005 |
| 32846 | 0.004 |
| 32847 | 0.002 |
| 32848 | 0.003 |
| 32849 | 0.001 |
| 32850 | 0.003 |
| 32851 | 0.001 |
| 32852 | 0.003 |
| 32853 | 0.007 |
| 32854 | 0.003 |
| 32855 | 0.002 |
| 32856 | 0.007 |
| 32857 | 0.001 |
| 32858 | 0.003 |
| 32859 | 0.002 |
| 32860 | 0.007 |
| 32861 | 0.006 |
| 32862 | 0.002 |
| 32863 | 0.002 |
| 32864 | 0.004 |
| 32865 | 0.009 |
| 32866 | 0.002 |
| 32867 | 0.003 |
| 32868 | 0.003 |
| 32869 | 0.007 |
| 32870 | 0.005 |
| 32871 | 0.003 |
| 32872 | 0.006 |
| 32873 | 0.007 |
| 32874 | 0.003 |
| 32875 | 0.004 |
| 32876 | 0.005 |
| 32877 | 0.005 |
| 32878 | 0.003 |
| 32879 | 0.002 |
| 32880 | 0.002 |
| 32881 | 0.002 |
| 32882 | 0.001 |
| 32883 | 0.002 |
| 32884 | 0.002 |
| 32885 | 0.003 |
| 32886 | 0.004 |
| 32887 | 0.005 |
| 32888 | 0.006 |
| 32889 | 0.007 |
| 32890 | 0.004 |
| 32891 | 0.006 |
| 32892 | 0.003 |
| 32893 | 0.005 |
| 32894 | 0.006 |
| 32895 | 0.003 |
| 32896 | 0.002 |
| 32897 | 0.009 |
| 32898 | 0.003 |
| 32899 | 0.003 |
| 32900 | 0.007 |
| 32901 | 0.003 |
| 32902 | 0.004 |
| 32903 | 0.002 |
| 32904 | 0.006 |
| 32905 | 0.006 |
| 32906 | 0.003 |
| 32907 | 0.003 |
| 32908 | 0.007 |
| 32909 | 0.006 |
| 32910 | 0.001 |
| 32911 | 0.003 |
| 32912 | 0.003 |
| 32913 | 0.006 |
| 32914 | 0.003 |
| 32915 | 0.001 |
| 32916 | 0.002 |
| 32917 | 0.002 |
| 32918 | 0.003 |
| 32919 | 0.008 |
| 32920 | 0.003 |
| 32921 | 0.005 |
| 32922 | 0.002 |
| 32923 | 0.003 |
| 32924 | 0.006 |
| 32925 | 0.005 |
| 32926 | 0.002 |
| 32927 | 0.003 |
| 32928 | 0.006 |
| 32929 | 0.006 |
| 32930 | 0.002 |
| 32931 | 0.001 |
| 32932 | 0.002 |
| 32933 | 0.004 |
| 32934 | 0.003 |
| 32935 | 0.002 |
| 32936 | 0.006 |
| 32937 | 0.009 |
| 32938 | 0.002 |
| 32939 | 0.003 |
| 32940 | 0.007 |
| 32941 | 0.012 |
| 32942 | 0.007 |
| 32943 | 0.004 |
| 32944 | 0.004 |
| 32945 | 0.003 |
| 32946 | 0.002 |
| 32947 | 0.009 |
| 32948 | 0.005 |
| 32949 | 0.004 |
| 32950 | 0.002 |
| 32951 | 0.001 |
| 32952 | 0.002 |
| 32953 | 0.006 |
| 32954 | 0.001 |
| 32955 | 0.002 |
| 32956 | 0.001 |
| 32957 | 0.002 |
| 32958 | 0.001 |
| 32959 | 0.002 |
| 32960 | 0.008 |
| 32961 | 0.005 |
| 32962 | 0.002 |
| 32963 | 0.001 |
| 32964 | 0.007 |
| 32965 | 0.013 |
| 32966 | 0.001 |
| 32967 | 0.005 |
| 32968 | 0.002 |
| 32969 | 0.005 |
| 32970 | 0 |
| 32971 | 0.004 |
| 32972 | 0.004 |
| 32973 | 0.006 |
| 32974 | 0.004 |
| 32975 | 0.002 |
| 32976 | 0.002 |
| 32977 | 0.005 |
| 32978 | 0.003 |
| 32979 | 0.001 |
| 32980 | 0.001 |
| 32981 | 0.008 |
| 32982 | 0.001 |
| 32983 | 0.001 |
| 32984 | 0.002 |
| 32985 | 0.008 |
| 32986 | 0.001 |
| 32987 | 0.002 |
| 32988 | 0.006 |
| 32989 | 0.007 |
| 32990 | 0.003 |
| 32991 | 0.005 |
| 32992 | 0.003 |
| 32993 | 0.005 |
| 32994 | 0.006 |
| 32995 | 0.005 |
| 32996 | 0.002 |
| 32997 | 0.006 |
| 32998 | 0.002 |
| 32999 | 0.002 |
| 33000 | 0.004 |
| 33001 | 0.005 |
| 33002 | 0.002 |
| 33003 | 0.003 |
| 33004 | 0.004 |
| 33005 | 0.002 |
| 33006 | 0.001 |
| 33007 | 0.002 |
| 33008 | 0.006 |
| 33009 | 0.004 |
| 33010 | 0.002 |
| 33011 | 0.003 |
| 33012 | 0.003 |
| 33013 | 0.007 |
| 33014 | 0.002 |
| 33015 | 0.004 |
| 33016 | 0.002 |
| 33017 | 0.008 |
| 33018 | 0.003 |
| 33019 | 0.002 |
| 33020 | 0.001 |
| 33021 | 0.003 |
| 33022 | 0.008 |
| 33023 | 0.005 |
| 33024 | 0.003 |
| 33025 | 0.003 |
| 33026 | 0.005 |
| 33027 | 0.002 |
| 33028 | 0.009 |
| 33029 | 0.007 |
| 33030 | 0.002 |
| 33031 | 0.005 |
| 33032 | 0.008 |
| 33033 | 0.006 |
| 33034 | 0.004 |
| 33035 | 0.003 |
| 33036 | 0.007 |
| 33037 | 0.005 |
| 33038 | 0.002 |
| 33039 | 0.002 |
| 33040 | 0.002 |
| 33041 | 0.002 |
| 33042 | 0.002 |
| 33043 | 0.002 |
| 33044 | 0.01 |
| 33045 | 0.001 |
| 33046 | 0.006 |
| 33047 | 0.001 |
| 33048 | 0.005 |
| 33049 | 0.007 |
| 33050 | 0.008 |
| 33051 | 0.005 |
| 33052 | 0.003 |
| 33053 | 0.003 |
| 33054 | 0.002 |
| 33055 | 0.004 |
| 33056 | 0.001 |
| 33057 | 0.006 |
| 33058 | 0.006 |
| 33059 | 0.004 |
| 33060 | 0.007 |
| 33061 | 0.005 |
| 33062 | 0.004 |
| 33063 | 0.007 |
| 33064 | 0.008 |
| 33065 | 0.009 |
| 33066 | 0.008 |
| 33067 | 0.006 |
| 33068 | 0.004 |
| 33069 | 0.005 |
| 33070 | 0.006 |
| 33071 | 0.008 |
| 33072 | 0.005 |
| 33073 | 0.002 |
| 33074 | 0.005 |
| 33075 | 0.003 |
| 33076 | 0.004 |
| 33077 | 0.006 |
| 33078 | 0.002 |
| 33079 | 0.005 |
| 33080 | 0.005 |
| 33081 | 0.002 |
| 33082 | 0.004 |
| 33083 | 0.004 |
| 33084 | 0.006 |
| 33085 | 0.011 |
| 33086 | 0.003 |
| 33087 | 0.005 |
| 33088 | 0.007 |
| 33089 | 0.005 |
| 33090 | 0.004 |
| 33091 | 0.006 |
| 33092 | 0.002 |
| 33093 | 0.01 |
| 33094 | 0.009 |
| 33095 | 0.003 |
| 33096 | 0.005 |
| 33097 | 0.007 |
| 33098 | 0.005 |
| 33099 | 0.011 |
| 33100 | 0.008 |
| 33101 | 0.001 |
| 33102 | 0.005 |
| 33103 | 0.004 |
| 33104 | 0.008 |
| 33105 | 0.002 |
| 33106 | 0.002 |
| 33107 | 0.003 |
| 33108 | 0.005 |
| 33109 | 0.004 |
| 33110 | 0.004 |
| 33111 | 0.003 |
| 33112 | 0.004 |
| 33113 | 0.005 |
| 33114 | 0.003 |
| 33115 | 0.005 |
| 33116 | 0.003 |
| 33117 | 0.002 |
| 33118 | 0.003 |
| 33119 | 0.005 |
| 33120 | 0.002 |
| 33121 | 0.001 |
| 33122 | 0.003 |
| 33123 | 0.008 |
| 33124 | 0.006 |
| 33125 | 0.001 |
| 33126 | 0.004 |
| 33127 | 0.002 |
| 33128 | 0.011 |
| 33129 | 0.003 |
| 33130 | 0.004 |
| 33131 | 0.002 |
| 33132 | 0.001 |
| 33133 | 0.002 |
| 33134 | 0.002 |
| 33135 | 0.003 |
| 33136 | 0.004 |
| 33137 | 0.008 |
| 33138 | 0.007 |
| 33139 | 0.007 |
| 33140 | 0.006 |
| 33141 | 0.002 |
| 33142 | 0.003 |
| 33143 | 0.003 |
| 33144 | 0.003 |
| 33145 | 0.003 |
| 33146 | 0.001 |
| 33147 | 0.005 |
| 33148 | 0.003 |
| 33149 | 0.003 |
| 33150 | 0.005 |
| 33151 | 0.003 |
| 33152 | 0.009 |
| 33153 | 0.006 |
| 33154 | 0.003 |
| 33155 | 0.006 |
| 33156 | 0.007 |
| 33157 | 0.001 |
| 33158 | 0.004 |
| 33159 | 0.003 |
| 33160 | 0.004 |
| 33161 | 0.003 |
| 33162 | 0.002 |
| 33163 | 0.004 |
| 33164 | 0.003 |
| 33165 | 0.001 |
| 33166 | 0.004 |
| 33167 | 0.007 |
| 33168 | 0.007 |
| 33169 | 0.005 |
| 33170 | 0.005 |
| 33171 | 0.007 |
| 33172 | 0.005 |
| 33173 | 0.003 |
| 33174 | 0.007 |
| 33175 | 0.008 |
| 33176 | 0.006 |
| 33177 | 0.002 |
| 33178 | 0.006 |
| 33179 | 0.008 |
| 33180 | 0.008 |
| 33181 | 0.004 |
| 33182 | 0.003 |
| 33183 | 0.006 |
| 33184 | 0.003 |
| 33185 | 0.002 |
| 33186 | 0.004 |
| 33187 | 0.007 |
| 33188 | 0.008 |
| 33189 | 0.002 |
| 33190 | 0.001 |
| 33191 | 0.003 |
| 33192 | 0.002 |
| 33193 | 0.001 |
| 33194 | 0.006 |
| 33195 | 0.005 |
| 33196 | 0.005 |
| 33197 | 0.004 |
| 33198 | 0.001 |
| 33199 | 0.002 |
| 33200 | 0.006 |
| 33201 | 0.001 |
| 33202 | 0.004 |
| 33203 | 0.001 |
| 33204 | 0.007 |
| 33205 | 0.006 |
| 33206 | 0.003 |
| 33207 | 0.005 |
| 33208 | 0.012 |
| 33209 | 0.01 |
| 33210 | 0.002 |
| 33211 | 0.005 |
| 33212 | 0.004 |
| 33213 | 0.012 |
| 33214 | 0.002 |
| 33215 | 0.006 |
| 33216 | 0.004 |
| 33217 | 0.005 |
| 33218 | 0.004 |
| 33219 | 0.004 |
| 33220 | 0.007 |
| 33221 | 0.01 |
| 33222 | 0.005 |
| 33223 | 0.001 |
| 33224 | 0.006 |
| 33225 | 0.009 |
| 33226 | 0.003 |
| 33227 | 0.005 |
| 33228 | 0.001 |
| 33229 | 0.001 |
| 33230 | 0.003 |
| 33231 | 0.003 |
| 33232 | 0 |
| 33233 | 0.005 |
| 33234 | 0.003 |
| 33235 | 0.002 |
| 33236 | 0.005 |
| 33237 | 0.002 |
| 33238 | 0.003 |
| 33239 | 0.005 |
| 33240 | 0.008 |
| 33241 | 0.008 |
| 33242 | 0.004 |
| 33243 | 0.002 |
| 33244 | 0.006 |
| 33245 | 0.007 |
| 33246 | 0.006 |
| 33247 | 0.002 |
| 33248 | 0.004 |
| 33249 | 0.002 |
| 33250 | 0.001 |
| 33251 | 0.003 |
| 33252 | 0.01 |
| 33253 | 0.004 |
| 33254 | 0.006 |
| 33255 | 0.004 |
| 33256 | 0.004 |
| 33257 | 0.004 |
| 33258 | 0.002 |
| 33259 | 0.007 |
| 33260 | 0.008 |
| 33261 | 0.003 |
| 33262 | 0.002 |
| 33263 | 0.002 |
| 33264 | 0.002 |
| 33265 | 0.005 |
| 33266 | 0.004 |
| 33267 | 0.005 |
| 33268 | 0.005 |
| 33269 | 0.008 |
| 33270 | 0.006 |
| 33271 | 0.005 |
| 33272 | 0.004 |
| 33273 | 0.004 |
| 33274 | 0.002 |
| 33275 | 0.003 |
| 33276 | 0.008 |
| 33277 | 0.009 |
| 33278 | 0.003 |
| 33279 | 0.004 |
| 33280 | 0.007 |
| 33281 | 0.003 |
| 33282 | 0.005 |
| 33283 | 0.007 |
| 33284 | 0.005 |
| 33285 | 0.001 |
| 33286 | 0.002 |
| 33287 | 0.002 |
| 33288 | 0.004 |
| 33289 | 0.004 |
| 33290 | 0.005 |
| 33291 | 0.009 |
| 33292 | 0.01 |
| 33293 | 0.002 |
| 33294 | 0.003 |
| 33295 | 0.004 |
| 33296 | 0.004 |
| 33297 | 0.003 |
| 33298 | 0.002 |
| 33299 | 0.005 |
| 33300 | 0.004 |
| 33301 | 0.004 |
| 33302 | 0.002 |
| 33303 | 0.002 |
| 33304 | 0.003 |
| 33305 | 0.003 |
| 33306 | 0.002 |
| 33307 | 0.002 |
| 33308 | 0.002 |
| 33309 | 0.004 |
| 33310 | 0.004 |
| 33311 | 0.004 |
| 33312 | 0.005 |
| 33313 | 0.002 |
| 33314 | 0.002 |
| 33315 | 0.008 |
| 33316 | 0.007 |
| 33317 | 0.007 |
| 33318 | 0.005 |
| 33319 | 0.008 |
| 33320 | 0.003 |
| 33321 | 0.006 |
| 33322 | 0.001 |
| 33323 | 0.001 |
| 33324 | 0.008 |
| 33325 | 0.01 |
| 33326 | 0.003 |
| 33327 | 0.002 |
| 33328 | 0.002 |
| 33329 | 0.007 |
| 33330 | 0.002 |
| 33331 | 0.002 |
| 33332 | 0.002 |
| 33333 | 0.001 |
| 33334 | 0.002 |
| 33335 | 0.006 |
| 33336 | 0.004 |
| 33337 | 0.003 |
| 33338 | 0.003 |
| 33339 | 0.003 |
| 33340 | 0.01 |
| 33341 | 0.002 |
| 33342 | 0.006 |
| 33343 | 0.006 |
| 33344 | 0.001 |
| 33345 | 0.003 |
| 33346 | 0.003 |
| 33347 | 0.003 |
| 33348 | 0.001 |
| 33349 | 0.003 |
| 33350 | 0.005 |
| 33351 | 0.005 |
| 33352 | 0.002 |
| 33353 | 0.002 |
| 33354 | 0.005 |
| 33355 | 0.01 |
| 33356 | 0.006 |
| 33357 | 0.005 |
| 33358 | 0.002 |
| 33359 | 0.009 |
| 33360 | 0.008 |
| 33361 | 0.006 |
| 33362 | 0.009 |
| 33363 | 0.003 |
| 33364 | 0.007 |
| 33365 | 0.004 |
| 33366 | 0.011 |
| 33367 | 0.012 |
| 33368 | 0.004 |
| 33369 | 0.002 |
| 33370 | 0.005 |
| 33371 | 0.002 |
| 33372 | 0.004 |
| 33373 | 0.004 |
| 33374 | 0.006 |
| 33375 | 0.005 |
| 33376 | 0.005 |
| 33377 | 0.002 |
| 33378 | 0.003 |
| 33379 | 0.009 |
| 33380 | 0.002 |
| 33381 | 0.005 |
| 33382 | 0.005 |
| 33383 | 0.003 |
| 33384 | 0.006 |
| 33385 | 0.008 |
| 33386 | 0.007 |
| 33387 | 0.004 |
| 33388 | 0.007 |
| 33389 | 0.004 |
| 33390 | 0.005 |
| 33391 | 0.004 |
| 33392 | 0.008 |
| 33393 | 0.005 |
| 33394 | 0.003 |
| 33395 | 0.003 |
| 33396 | 0.005 |
| 33397 | 0.004 |
| 33398 | 0.005 |
| 33399 | 0.014 |
| 33400 | 0.003 |
| 33401 | 0.011 |
| 33402 | 0.006 |
| 33403 | 0.004 |
| 33404 | 0.008 |
| 33405 | 0.005 |
| 33406 | 0.004 |
| 33407 | 0.005 |
| 33408 | 0.006 |
| 33409 | 0.003 |
| 33410 | 0.003 |
| 33411 | 0.003 |
| 33412 | 0.002 |
| 33413 | 0.007 |
| 33414 | 0.004 |
| 33415 | 0.001 |
| 33416 | 0.002 |
| 33417 | 0.005 |
| 33418 | 0.002 |
| 33419 | 0.003 |
| 33420 | 0.009 |
| 33421 | 0.003 |
| 33422 | 0.003 |
| 33423 | 0.002 |
| 33424 | 0.005 |
| 33425 | 0.007 |
| 33426 | 0.001 |
| 33427 | 0.002 |
| 33428 | 0.005 |
| 33429 | 0.007 |
| 33430 | 0.004 |
| 33431 | 0.006 |
| 33432 | 0.002 |
| 33433 | 0.001 |
| 33434 | 0.003 |
| 33435 | 0.004 |
| 33436 | 0.005 |
| 33437 | 0.004 |
| 33438 | 0.002 |
| 33439 | 0.003 |
| 33440 | 0.005 |
| 33441 | 0.008 |
| 33442 | 0.002 |
| 33443 | 0.003 |
| 33444 | 0.003 |
| 33445 | 0.002 |
| 33446 | 0.003 |
| 33447 | 0.004 |
| 33448 | 0.004 |
| 33449 | 0.005 |
| 33450 | 0.004 |
| 33451 | 0.002 |
| 33452 | 0.01 |
| 33453 | 0.006 |
| 33454 | 0.001 |
| 33455 | 0.006 |
| 33456 | 0.005 |
| 33457 | 0.003 |
| 33458 | 0.002 |
| 33459 | 0.007 |
| 33460 | 0.009 |
| 33461 | 0.004 |
| 33462 | 0.002 |
| 33463 | 0.002 |
| 33464 | 0.003 |
| 33465 | 0 |
| 33466 | 0.002 |
| 33467 | 0.005 |
| 33468 | 0.005 |
| 33469 | 0.002 |
| 33470 | 0.005 |
| 33471 | 0.002 |
| 33472 | 0.003 |
| 33473 | 0.002 |
| 33474 | 0.002 |
| 33475 | 0.002 |
| 33476 | 0.012 |
| 33477 | 0.01 |
| 33478 | 0.003 |
| 33479 | 0.003 |
| 33480 | 0.003 |
| 33481 | 0.007 |
| 33482 | 0.001 |
| 33483 | 0.003 |
| 33484 | 0.005 |
| 33485 | 0.008 |
| 33486 | 0.004 |
| 33487 | 0.005 |
| 33488 | 0.005 |
| 33489 | 0.002 |
| 33490 | 0.003 |
| 33491 | 0.002 |
| 33492 | 0.003 |
| 33493 | 0.006 |
| 33494 | 0.002 |
| 33495 | 0.005 |
| 33496 | 0.002 |
| 33497 | 0.005 |
| 33498 | 0.004 |
| 33499 | 0.002 |
| 33500 | 0.004 |
| 33501 | 0.002 |
| 33502 | 0.002 |
| 33503 | 0.004 |
| 33504 | 0.003 |
| 33505 | 0.004 |
| 33506 | 0.002 |
| 33507 | 0.005 |
| 33508 | 0.005 |
| 33509 | 0.006 |
| 33510 | 0.002 |
| 33511 | 0.002 |
| 33512 | 0.007 |
| 33513 | 0.005 |
| 33514 | 0.003 |
| 33515 | 0.007 |
| 33516 | 0.008 |
| 33517 | 0.008 |
| 33518 | 0.002 |
| 33519 | 0.002 |
| 33520 | 0.008 |
| 33521 | 0.003 |
| 33522 | 0.001 |
| 33523 | 0.003 |
| 33524 | 0.003 |
| 33525 | 0.004 |
| 33526 | 0.002 |
| 33527 | 0.001 |
| 33528 | 0.008 |
| 33529 | 0.006 |
| 33530 | 0.003 |
| 33531 | 0.003 |
| 33532 | 0.005 |
| 33533 | 0.004 |
| 33534 | 0.002 |
| 33535 | 0.007 |
| 33536 | 0.002 |
| 33537 | 0.005 |
| 33538 | 0.001 |
| 33539 | 0.004 |
| 33540 | 0.001 |
| 33541 | 0.003 |
| 33542 | 0.005 |
| 33543 | 0.004 |
| 33544 | 0.003 |
| 33545 | 0.002 |
| 33546 | 0.003 |
| 33547 | 0.002 |
| 33548 | 0.005 |
| 33549 | 0.008 |
| 33550 | 0.003 |
| 33551 | 0.005 |
| 33552 | 0.006 |
| 33553 | 0.009 |
| 33554 | 0.003 |
| 33555 | 0.003 |
| 33556 | 0.003 |
| 33557 | 0.004 |
| 33558 | 0.002 |
| 33559 | 0.003 |
| 33560 | 0.005 |
| 33561 | 0.005 |
| 33562 | 0.003 |
| 33563 | 0.002 |
| 33564 | 0.002 |
| 33565 | 0.003 |
| 33566 | 0.002 |
| 33567 | 0.002 |
| 33568 | 0.004 |
| 33569 | 0.003 |
| 33570 | 0.003 |
| 33571 | 0.004 |
| 33572 | 0.003 |
| 33573 | 0.001 |
| 33574 | 0.002 |
| 33575 | 0.003 |
| 33576 | 0.001 |
| 33577 | 0.004 |
| 33578 | 0.003 |
| 33579 | 0.004 |
| 33580 | 0.004 |
| 33581 | 0.003 |
| 33582 | 0.005 |
| 33583 | 0.005 |
| 33584 | 0.003 |
| 33585 | 0.007 |
| 33586 | 0.005 |
| 33587 | 0.004 |
| 33588 | 0.004 |
| 33589 | 0.008 |
| 33590 | 0.002 |
| 33591 | 0.003 |
| 33592 | 0.006 |
| 33593 | 0.004 |
| 33594 | 0.006 |
| 33595 | 0.004 |
| 33596 | 0.004 |
| 33597 | 0.007 |
| 33598 | 0.001 |
| 33599 | 0.002 |
| 33600 | 0.005 |
| 33601 | 0.003 |
| 33602 | 0.002 |
| 33603 | 0.001 |
| 33604 | 0.009 |
| 33605 | 0.005 |
| 33606 | 0.003 |
| 33607 | 0.004 |
| 33608 | 0.005 |
| 33609 | 0.006 |
| 33610 | 0.003 |
| 33611 | 0.006 |
| 33612 | 0.005 |
| 33613 | 0.003 |
| 33614 | 0.004 |
| 33615 | 0.003 |
| 33616 | 0.004 |
| 33617 | 0.01 |
| 33618 | 0.004 |
| 33619 | 0.005 |
| 33620 | 0.008 |
| 33621 | 0.005 |
| 33622 | 0.002 |
| 33623 | 0.004 |
| 33624 | 0.002 |
| 33625 | 0.001 |
| 33626 | 0.002 |
| 33627 | 0.006 |
| 33628 | 0.007 |
| 33629 | 0.001 |
| 33630 | 0.004 |
| 33631 | 0.003 |
| 33632 | 0.002 |
| 33633 | 0.001 |
| 33634 | 0.004 |
| 33635 | 0.004 |
| 33636 | 0.005 |
| 33637 | 0.003 |
| 33638 | 0.001 |
| 33639 | 0.003 |
| 33640 | 0.003 |
| 33641 | 0.002 |
| 33642 | 0.004 |
| 33643 | 0.002 |
| 33644 | 0.002 |
| 33645 | 0.004 |
| 33646 | 0.005 |
| 33647 | 0.004 |
| 33648 | 0.012 |
| 33649 | 0.002 |
| 33650 | 0.003 |
| 33651 | 0.001 |
| 33652 | 0.002 |
| 33653 | 0.013 |
| 33654 | 0.005 |
| 33655 | 0.003 |
| 33656 | 0.009 |
| 33657 | 0.005 |
| 33658 | 0.003 |
| 33659 | 0.004 |
| 33660 | 0.006 |
| 33661 | 0.005 |
| 33662 | 0.008 |
| 33663 | 0.01 |
| 33664 | 0.009 |
| 33665 | 0.004 |
| 33666 | 0.003 |
| 33667 | 0.006 |
| 33668 | 0.005 |
| 33669 | 0.002 |
| 33670 | 0.006 |
| 33671 | 0.001 |
| 33672 | 0.002 |
| 33673 | 0.001 |
| 33674 | 0.005 |
| 33675 | 0.011 |
| 33676 | 0.009 |
| 33677 | 0.005 |
| 33678 | 0.003 |
| 33679 | 0.004 |
| 33680 | 0.005 |
| 33681 | 0.004 |
| 33682 | 0.012 |
| 33683 | 0.006 |
| 33684 | 0.004 |
| 33685 | 0.006 |
| 33686 | 0.004 |
| 33687 | 0.004 |
| 33688 | 0.003 |
| 33689 | 0.012 |
| 33690 | 0.009 |
| 33691 | 0.003 |
| 33692 | 0.003 |
| 33693 | 0.004 |
| 33694 | 0.006 |
| 33695 | 0.004 |
| 33696 | 0.004 |
| 33697 | 0.002 |
| 33698 | 0.006 |
| 33699 | 0.007 |
| 33700 | 0.007 |
| 33701 | 0.006 |
| 33702 | 0.002 |
| 33703 | 0.009 |
| 33704 | 0.007 |
| 33705 | 0.003 |
| 33706 | 0.002 |
| 33707 | 0.004 |
| 33708 | 0.003 |
| 33709 | 0.002 |
| 33710 | 0.002 |
| 33711 | 0.005 |
| 33712 | 0.012 |
| 33713 | 0.001 |
| 33714 | 0.002 |
| 33715 | 0.003 |
| 33716 | 0.001 |
| 33717 | 0.005 |
| 33718 | 0.002 |
| 33719 | 0.003 |
| 33720 | 0.001 |
| 33721 | 0.002 |
| 33722 | 0.004 |
| 33723 | 0.007 |
| 33724 | 0.006 |
| 33725 | 0.004 |
| 33726 | 0.002 |
| 33727 | 0.007 |
| 33728 | 0.002 |
| 33729 | 0.006 |
| 33730 | 0.002 |
| 33731 | 0.008 |
| 33732 | 0.003 |
| 33733 | 0.002 |
| 33734 | 0.002 |
| 33735 | 0.003 |
| 33736 | 0.005 |
| 33737 | 0.002 |
| 33738 | 0.007 |
| 33739 | 0.006 |
| 33740 | 0.004 |
| 33741 | 0.002 |
| 33742 | 0.001 |
| 33743 | 0.004 |
| 33744 | 0.009 |
| 33745 | 0.002 |
| 33746 | 0.002 |
| 33747 | 0.003 |
| 33748 | 0.004 |
| 33749 | 0.004 |
| 33750 | 0.001 |
| 33751 | 0.006 |
| 33752 | 0.009 |
| 33753 | 0.005 |
| 33754 | 0.004 |
| 33755 | 0.007 |
| 33756 | 0.005 |
| 33757 | 0.003 |
| 33758 | 0.004 |
| 33759 | 0.006 |
| 33760 | 0.006 |
| 33761 | 0.001 |
| 33762 | 0.002 |
| 33763 | 0.003 |
| 33764 | 0.004 |
| 33765 | 0.002 |
| 33766 | 0.004 |
| 33767 | 0.002 |
| 33768 | 0.003 |
| 33769 | 0.002 |
| 33770 | 0.001 |
| 33771 | 0.002 |
| 33772 | 0.004 |
| 33773 | 0.002 |
| 33774 | 0.001 |
| 33775 | 0.001 |
| 33776 | 0.007 |
| 33777 | 0.008 |
| 33778 | 0.001 |
| 33779 | 0.001 |
| 33780 | 0.006 |
| 33781 | 0.007 |
| 33782 | 0.006 |
| 33783 | 0.004 |
| 33784 | 0.003 |
| 33785 | 0.007 |
| 33786 | 0.002 |
| 33787 | 0.002 |
| 33788 | 0.009 |
| 33789 | 0.01 |
| 33790 | 0.003 |
| 33791 | 0.002 |
| 33792 | 0.007 |
| 33793 | 0.004 |
| 33794 | 0.002 |
| 33795 | 0.003 |
| 33796 | 0.01 |
| 33797 | 0.005 |
| 33798 | 0.004 |
| 33799 | 0.007 |
| 33800 | 0.004 |
| 33801 | 0.005 |
| 33802 | 0.005 |
| 33803 | 0.005 |
| 33804 | 0.005 |
| 33805 | 0.004 |
| 33806 | 0.004 |
| 33807 | 0.002 |
| 33808 | 0.005 |
| 33809 | 0.007 |
| 33810 | 0.004 |
| 33811 | 0.001 |
| 33812 | 0.001 |
| 33813 | 0.002 |
| 33814 | 0.005 |
| 33815 | 0.003 |
| 33816 | 0.01 |
| 33817 | 0.006 |
| 33818 | 0.002 |
| 33819 | 0.003 |
| 33820 | 0.003 |
| 33821 | 0.011 |
| 33822 | 0.001 |
| 33823 | 0.005 |
| 33824 | 0.006 |
| 33825 | 0.004 |
| 33826 | 0.005 |
| 33827 | 0.005 |
| 33828 | 0.004 |
| 33829 | 0.002 |
| 33830 | 0.001 |
| 33831 | 0.004 |
| 33832 | 0.003 |
| 33833 | 0.002 |
| 33834 | 0.003 |
| 33835 | 0.006 |
| 33836 | 0.004 |
| 33837 | 0.005 |
| 33838 | 0.004 |
| 33839 | 0.004 |
| 33840 | 0.003 |
| 33841 | 0.002 |
| 33842 | 0.005 |
| 33843 | 0.007 |
| 33844 | 0.002 |
| 33845 | 0.002 |
| 33846 | 0.003 |
| 33847 | 0.003 |
| 33848 | 0.005 |
| 33849 | 0.001 |
| 33850 | 0.003 |
| 33851 | 0.003 |
| 33852 | 0.003 |
| 33853 | 0.005 |
| 33854 | 0.008 |
| 33855 | 0.01 |
| 33856 | 0.008 |
| 33857 | 0.004 |
| 33858 | 0.001 |
| 33859 | 0.003 |
| 33860 | 0.002 |
| 33861 | 0.003 |
| 33862 | 0.005 |
| 33863 | 0.01 |
| 33864 | 0.009 |
| 33865 | 0.002 |
| 33866 | 0.003 |
| 33867 | 0.004 |
| 33868 | 0.002 |
| 33869 | 0.005 |
| 33870 | 0.003 |
| 33871 | 0.003 |
| 33872 | 0.009 |
| 33873 | 0.005 |
| 33874 | 0.002 |
| 33875 | 0.004 |
| 33876 | 0.008 |
| 33877 | 0.001 |
| 33878 | 0.004 |
| 33879 | 0.002 |
| 33880 | 0.005 |
| 33881 | 0.004 |
| 33882 | 0.006 |
| 33883 | 0.005 |
| 33884 | 0.005 |
| 33885 | 0.002 |
| 33886 | 0.003 |
| 33887 | 0.006 |
| 33888 | 0.004 |
| 33889 | 0.003 |
| 33890 | 0.001 |
| 33891 | 0.002 |
| 33892 | 0.003 |
| 33893 | 0.001 |
| 33894 | 0.003 |
| 33895 | 0.004 |
| 33896 | 0.002 |
| 33897 | 0.001 |
| 33898 | 0.001 |
| 33899 | 0.004 |
| 33900 | 0.004 |
| 33901 | 0.004 |
| 33902 | 0.003 |
| 33903 | 0.006 |
| 33904 | 0.005 |
| 33905 | 0.009 |
| 33906 | 0.006 |
| 33907 | 0.005 |
| 33908 | 0.003 |
| 33909 | 0.003 |
| 33910 | 0.002 |
| 33911 | 0.004 |
| 33912 | 0.006 |
| 33913 | 0.009 |
| 33914 | 0.002 |
| 33915 | 0.002 |
| 33916 | 0.01 |
| 33917 | 0.009 |
| 33918 | 0.001 |
| 33919 | 0.004 |
| 33920 | 0.005 |
| 33921 | 0.005 |
| 33922 | 0.003 |
| 33923 | 0.001 |
| 33924 | 0.002 |
| 33925 | 0.003 |
| 33926 | 0.003 |
| 33927 | 0.007 |
| 33928 | 0.001 |
| 33929 | 0.002 |
| 33930 | 0.005 |
| 33931 | 0.005 |
| 33932 | 0.003 |
| 33933 | 0.003 |
| 33934 | 0.004 |
| 33935 | 0.005 |
| 33936 | 0.002 |
| 33937 | 0.005 |
| 33938 | 0.002 |
| 33939 | 0.004 |
| 33940 | 0.004 |
| 33941 | 0.001 |
| 33942 | 0.006 |
| 33943 | 0.002 |
| 33944 | 0.004 |
| 33945 | 0.003 |
| 33946 | 0.003 |
| 33947 | 0.003 |
| 33948 | 0.003 |
| 33949 | 0.002 |
| 33950 | 0.003 |
| 33951 | 0.004 |
| 33952 | 0.004 |
| 33953 | 0.003 |
| 33954 | 0.003 |
| 33955 | 0.002 |
| 33956 | 0.001 |
| 33957 | 0.002 |
| 33958 | 0.004 |
| 33959 | 0.001 |
| 33960 | 0.002 |
| 33961 | 0.009 |
| 33962 | 0.013 |
| 33963 | 0.009 |
| 33964 | 0.006 |
| 33965 | 0.005 |
| 33966 | 0.007 |
| 33967 | 0.009 |
| 33968 | 0.005 |
| 33969 | 0.002 |
| 33970 | 0.006 |
| 33971 | 0.004 |
| 33972 | 0.006 |
| 33973 | 0.006 |
| 33974 | 0.004 |
| 33975 | 0.012 |
| 33976 | 0.006 |
| 33977 | 0.006 |
| 33978 | 0.004 |
| 33979 | 0.003 |
| 33980 | 0.002 |
| 33981 | 0.009 |
| 33982 | 0.001 |
| 33983 | 0.002 |
| 33984 | 0.004 |
| 33985 | 0.009 |
| 33986 | 0.003 |
| 33987 | 0.006 |
| 33988 | 0.001 |
| 33989 | 0.002 |
| 33990 | 0.003 |
| 33991 | 0.005 |
| 33992 | 0.004 |
| 33993 | 0.006 |
| 33994 | 0.003 |
| 33995 | 0.004 |
| 33996 | 0.007 |
| 33997 | 0.004 |
| 33998 | 0.004 |
| 33999 | 0.005 |
| 34000 | 0.006 |
| 34001 | 0.008 |
| 34002 | 0.006 |
| 34003 | 0.003 |
| 34004 | 0.011 |
| 34005 | 0.006 |
| 34006 | 0.005 |
| 34007 | 0.006 |
| 34008 | 0.005 |
| 34009 | 0.006 |
| 34010 | 0.002 |
| 34011 | 0.002 |
| 34012 | 0.005 |
| 34013 | 0.007 |
| 34014 | 0.001 |
| 34015 | 0.002 |
| 34016 | 0.003 |
| 34017 | 0.007 |
| 34018 | 0.002 |
| 34019 | 0.004 |
| 34020 | 0.008 |
| 34021 | 0.002 |
| 34022 | 0.001 |
| 34023 | 0.005 |
| 34024 | 0.005 |
| 34025 | 0.002 |
| 34026 | 0.002 |
| 34027 | 0.007 |
| 34028 | 0.005 |
| 34029 | 0.003 |
| 34030 | 0.002 |
| 34031 | 0.003 |
| 34032 | 0.003 |
| 34033 | 0.006 |
| 34034 | 0.003 |
| 34035 | 0.002 |
| 34036 | 0.003 |
| 34037 | 0.002 |
| 34038 | 0.002 |
| 34039 | 0.002 |
| 34040 | 0.009 |
| 34041 | 0.003 |
| 34042 | 0.003 |
| 34043 | 0.004 |
| 34044 | 0.005 |
| 34045 | 0.007 |
| 34046 | 0.003 |
| 34047 | 0.003 |
| 34048 | 0.004 |
| 34049 | 0.01 |
| 34050 | 0.001 |
| 34051 | 0.004 |
| 34052 | 0.006 |
| 34053 | 0.005 |
| 34054 | 0.001 |
| 34055 | 0.003 |
| 34056 | 0.002 |
| 34057 | 0.005 |
| 34058 | 0.003 |
| 34059 | 0.003 |
| 34060 | 0.006 |
| 34061 | 0.006 |
| 34062 | 0.003 |
| 34063 | 0.003 |
| 34064 | 0.002 |
| 34065 | 0.004 |
| 34066 | 0.001 |
| 34067 | 0.002 |
| 34068 | 0.004 |
| 34069 | 0.002 |
| 34070 | 0.003 |
| 34071 | 0.004 |
| 34072 | 0.007 |
| 34073 | 0.007 |
| 34074 | 0.003 |
| 34075 | 0.004 |
| 34076 | 0.005 |
| 34077 | 0.004 |
| 34078 | 0.002 |
| 34079 | 0.002 |
| 34080 | 0.004 |
| 34081 | 0.003 |
| 34082 | 0.002 |
| 34083 | 0.003 |
| 34084 | 0.004 |
| 34085 | 0.007 |
| 34086 | 0.002 |
| 34087 | 0.001 |
| 34088 | 0.01 |
| 34089 | 0.008 |
| 34090 | 0.006 |
| 34091 | 0.001 |
| 34092 | 0.002 |
| 34093 | 0.007 |
| 34094 | 0.003 |
| 34095 | 0.005 |
| 34096 | 0.004 |
| 34097 | 0.004 |
| 34098 | 0.004 |
| 34099 | 0.005 |
| 34100 | 0.003 |
| 34101 | 0.003 |
| 34102 | 0.004 |
| 34103 | 0.006 |
| 34104 | 0.006 |
| 34105 | 0.006 |
| 34106 | 0.002 |
| 34107 | 0.003 |
| 34108 | 0.004 |
| 34109 | 0.006 |
| 34110 | 0.002 |
| 34111 | 0.002 |
| 34112 | 0.006 |
| 34113 | 0.011 |
| 34114 | 0.002 |
| 34115 | 0.006 |
| 34116 | 0.005 |
| 34117 | 0.007 |
| 34118 | 0.005 |
| 34119 | 0.004 |
| 34120 | 0.008 |
| 34121 | 0.008 |
| 34122 | 0.002 |
| 34123 | 0.001 |
| 34124 | 0.007 |
| 34125 | 0.001 |
| 34126 | 0.003 |
| 34127 | 0.004 |
| 34128 | 0.001 |
| 34129 | 0.001 |
| 34130 | 0.004 |
| 34131 | 0.003 |
| 34132 | 0.012 |
| 34133 | 0.014 |
| 34134 | 0.003 |
| 34135 | 0.002 |
| 34136 | 0.007 |
| 34137 | 0.001 |
| 34138 | 0.001 |
| 34139 | 0.002 |
| 34140 | 0.004 |
| 34141 | 0.01 |
| 34142 | 0.004 |
| 34143 | 0.002 |
| 34144 | 0.003 |
| 34145 | 0.005 |
| 34146 | 0.002 |
| 34147 | 0.003 |
| 34148 | 0.005 |
| 34149 | 0.005 |
| 34150 | 0.002 |
| 34151 | 0.004 |
| 34152 | 0.005 |
| 34153 | 0.009 |
| 34154 | 0.003 |
| 34155 | 0.005 |
| 34156 | 0.008 |
| 34157 | 0.002 |
| 34158 | 0.002 |
| 34159 | 0.001 |
| 34160 | 0.002 |
| 34161 | 0.003 |
| 34162 | 0.005 |
| 34163 | 0.003 |
| 34164 | 0.003 |
| 34165 | 0.002 |
| 34166 | 0.002 |
| 34167 | 0.004 |
| 34168 | 0.006 |
| 34169 | 0.007 |
| 34170 | 0.005 |
| 34171 | 0.003 |
| 34172 | 0.006 |
| 34173 | 0.005 |
| 34174 | 0.005 |
| 34175 | 0.004 |
| 34176 | 0.006 |
| 34177 | 0.006 |
| 34178 | 0.002 |
| 34179 | 0.001 |
| 34180 | 0.004 |
| 34181 | 0.007 |
| 34182 | 0.002 |
| 34183 | 0.002 |
| 34184 | 0.007 |
| 34185 | 0.001 |
| 34186 | 0.003 |
| 34187 | 0.01 |
| 34188 | 0.016 |
| 34189 | 0.01 |
| 34190 | 0.002 |
| 34191 | 0.002 |
| 34192 | 0.001 |
| 34193 | 0.003 |
| 34194 | 0.002 |
| 34195 | 0.003 |
| 34196 | 0.008 |
| 34197 | 0.009 |
| 34198 | 0.005 |
| 34199 | 0.005 |
| 34200 | 0.004 |
| 34201 | 0.004 |
| 34202 | 0.003 |
| 34203 | 0.001 |
| 34204 | 0.007 |
| 34205 | 0.006 |
| 34206 | 0.004 |
| 34207 | 0.004 |
| 34208 | 0.003 |
| 34209 | 0.007 |
| 34210 | 0.003 |
| 34211 | 0.003 |
| 34212 | 0.005 |
| 34213 | 0.006 |
| 34214 | 0.001 |
| 34215 | 0.002 |
| 34216 | 0.004 |
| 34217 | 0.001 |
| 34218 | 0.003 |
| 34219 | 0.001 |
| 34220 | 0.002 |
| 34221 | 0.007 |
| 34222 | 0.002 |
| 34223 | 0.004 |
| 34224 | 0.002 |
| 34225 | 0.003 |
| 34226 | 0.003 |
| 34227 | 0.003 |
| 34228 | 0.001 |
| 34229 | 0.004 |
| 34230 | 0.008 |
| 34231 | 0.002 |
| 34232 | 0.003 |
| 34233 | 0.003 |
| 34234 | 0.002 |
| 34235 | 0.001 |
| 34236 | 0.002 |
| 34237 | 0.005 |
| 34238 | 0.007 |
| 34239 | 0.003 |
| 34240 | 0.005 |
| 34241 | 0.007 |
| 34242 | 0.002 |
| 34243 | 0.004 |
| 34244 | 0.007 |
| 34245 | 0.006 |
| 34246 | 0.005 |
| 34247 | 0.002 |
| 34248 | 0.005 |
| 34249 | 0.005 |
| 34250 | 0.006 |
| 34251 | 0.001 |
| 34252 | 0.004 |
| 34253 | 0.004 |
| 34254 | 0.001 |
| 34255 | 0.006 |
| 34256 | 0.003 |
| 34257 | 0.006 |
| 34258 | 0.001 |
| 34259 | 0.005 |
| 34260 | 0.008 |
| 34261 | 0.003 |
| 34262 | 0.005 |
| 34263 | 0.002 |
| 34264 | 0.011 |
| 34265 | 0.003 |
| 34266 | 0.005 |
| 34267 | 0.002 |
| 34268 | 0.002 |
| 34269 | 0.006 |
| 34270 | 0.005 |
| 34271 | 0.004 |
| 34272 | 0.002 |
| 34273 | 0.005 |
| 34274 | 0.005 |
| 34275 | 0.002 |
| 34276 | 0.003 |
| 34277 | 0.003 |
| 34278 | 0.002 |
| 34279 | 0.005 |
| 34280 | 0.004 |
| 34281 | 0.006 |
| 34282 | 0.005 |
| 34283 | 0.002 |
| 34284 | 0.004 |
| 34285 | 0.003 |
| 34286 | 0.01 |
| 34287 | 0.007 |
| 34288 | 0.004 |
| 34289 | 0.002 |
| 34290 | 0.004 |
| 34291 | 0.002 |
| 34292 | 0.002 |
| 34293 | 0.005 |
| 34294 | 0.006 |
| 34295 | 0.004 |
| 34296 | 0.003 |
| 34297 | 0.001 |
| 34298 | 0.006 |
| 34299 | 0.003 |
| 34300 | 0.003 |
| 34301 | 0.004 |
| 34302 | 0.009 |
| 34303 | 0.003 |
| 34304 | 0.004 |
| 34305 | 0.006 |
| 34306 | 0.004 |
| 34307 | 0.005 |
| 34308 | 0.002 |
| 34309 | 0.005 |
| 34310 | 0.002 |
| 34311 | 0.001 |
| 34312 | 0.005 |
| 34313 | 0.008 |
| 34314 | 0.003 |
| 34315 | 0.004 |
| 34316 | 0.001 |
| 34317 | 0.005 |
| 34318 | 0.003 |
| 34319 | 0.002 |
| 34320 | 0.004 |
| 34321 | 0.006 |
| 34322 | 0.003 |
| 34323 | 0.004 |
| 34324 | 0.004 |
| 34325 | 0.002 |
| 34326 | 0.002 |
| 34327 | 0.002 |
| 34328 | 0.005 |
| 34329 | 0.004 |
| 34330 | 0.002 |
| 34331 | 0.002 |
| 34332 | 0.005 |
| 34333 | 0.001 |
| 34334 | 0 |
| 34335 | 0.003 |
| 34336 | 0.005 |
| 34337 | 0.005 |
| 34338 | 0.002 |
| 34339 | 0.003 |
| 34340 | 0.001 |
| 34341 | 0.003 |
| 34342 | 0.002 |
| 34343 | 0.003 |
| 34344 | 0.002 |
| 34345 | 0.001 |
| 34346 | 0.005 |
| 34347 | 0.002 |
| 34348 | 0.008 |
| 34349 | 0.004 |
| 34350 | 0.005 |
| 34351 | 0.003 |
| 34352 | 0.004 |
| 34353 | 0.005 |
| 34354 | 0.002 |
| 34355 | 0.005 |
| 34356 | 0.01 |
| 34357 | 0.003 |
| 34358 | 0.007 |
| 34359 | 0.008 |
| 34360 | 0.01 |
| 34361 | 0.002 |
| 34362 | 0.003 |
| 34363 | 0.005 |
| 34364 | 0.004 |
| 34365 | 0.003 |
| 34366 | 0.004 |
| 34367 | 0.004 |
| 34368 | 0.009 |
| 34369 | 0.009 |
| 34370 | 0.002 |
| 34371 | 0.007 |
| 34372 | 0.008 |
| 34373 | 0.002 |
| 34374 | 0.004 |
| 34375 | 0.005 |
| 34376 | 0.005 |
| 34377 | 0.003 |
| 34378 | 0.003 |
| 34379 | 0.002 |
| 34380 | 0.002 |
| 34381 | 0.004 |
| 34382 | 0.004 |
| 34383 | 0.003 |
| 34384 | 0.006 |
| 34385 | 0.004 |
| 34386 | 0.003 |
| 34387 | 0.006 |
| 34388 | 0.007 |
| 34389 | 0.004 |
| 34390 | 0.003 |
| 34391 | 0.003 |
| 34392 | 0.004 |
| 34393 | 0.008 |
| 34394 | 0.001 |
| 34395 | 0.002 |
| 34396 | 0.003 |
| 34397 | 0.005 |
| 34398 | 0.005 |
| 34399 | 0.008 |
| 34400 | 0.004 |
| 34401 | 0.003 |
| 34402 | 0.001 |
| 34403 | 0.002 |
| 34404 | 0.015 |
| 34405 | 0.005 |
| 34406 | 0.003 |
| 34407 | 0.005 |
| 34408 | 0.004 |
| 34409 | 0.003 |
| 34410 | 0.002 |
| 34411 | 0.003 |
| 34412 | 0.004 |
| 34413 | 0.003 |
| 34414 | 0.003 |
| 34415 | 0.001 |
| 34416 | 0.007 |
| 34417 | 0.002 |
| 34418 | 0.003 |
| 34419 | 0.009 |
| 34420 | 0.005 |
| 34421 | 0.001 |
| 34422 | 0.002 |
| 34423 | 0.007 |
| 34424 | 0.002 |
| 34425 | 0.006 |
| 34426 | 0.004 |
| 34427 | 0.003 |
| 34428 | 0.004 |
| 34429 | 0.002 |
| 34430 | 0.002 |
| 34431 | 0.002 |
| 34432 | 0.005 |
| 34433 | 0.001 |
| 34434 | 0.004 |
| 34435 | 0.003 |
| 34436 | 0.003 |
| 34437 | 0.003 |
| 34438 | 0.001 |
| 34439 | 0.003 |
| 34440 | 0.003 |
| 34441 | 0.001 |
| 34442 | 0.001 |
| 34443 | 0.004 |
| 34444 | 0.001 |
| 34445 | 0.003 |
| 34446 | 0.004 |
| 34447 | 0.002 |
| 34448 | 0.003 |
| 34449 | 0.001 |
| 34450 | 0.002 |
| 34451 | 0.005 |
| 34452 | 0.006 |
| 34453 | 0.005 |
| 34454 | 0.003 |
| 34455 | 0.005 |
| 34456 | 0.008 |
| 34457 | 0.006 |
| 34458 | 0.002 |
| 34459 | 0.004 |
| 34460 | 0.003 |
| 34461 | 0.006 |
| 34462 | 0.003 |
| 34463 | 0.003 |
| 34464 | 0 |
| 34465 | 0.003 |
| 34466 | 0.004 |
| 34467 | 0.005 |
| 34468 | 0.008 |
| 34469 | 0.003 |
| 34470 | 0.002 |
| 34471 | 0.004 |
| 34472 | 0.005 |
| 34473 | 0.006 |
| 34474 | 0.002 |
| 34475 | 0.001 |
| 34476 | 0.004 |
| 34477 | 0.003 |
| 34478 | 0.003 |
| 34479 | 0.002 |
| 34480 | 0.003 |
| 34481 | 0.009 |
| 34482 | 0.003 |
| 34483 | 0.001 |
| 34484 | 0.002 |
| 34485 | 0.003 |
| 34486 | 0.003 |
| 34487 | 0.005 |
| 34488 | 0.006 |
| 34489 | 0.003 |
| 34490 | 0.003 |
| 34491 | 0.005 |
| 34492 | 0.003 |
| 34493 | 0.003 |
| 34494 | 0.004 |
| 34495 | 0.003 |
| 34496 | 0.002 |
| 34497 | 0.003 |
| 34498 | 0.003 |
| 34499 | 0.006 |
| 34500 | 0.003 |
| 34501 | 0.003 |
| 34502 | 0.003 |
| 34503 | 0.004 |
| 34504 | 0.008 |
| 34505 | 0.002 |
| 34506 | 0.009 |
| 34507 | 0.007 |
| 34508 | 0.007 |
| 34509 | 0.001 |
| 34510 | 0.003 |
| 34511 | 0.009 |
| 34512 | 0.004 |
| 34513 | 0.001 |
| 34514 | 0.003 |
| 34515 | 0.004 |
| 34516 | 0.005 |
| 34517 | 0.001 |
| 34518 | 0.001 |
| 34519 | 0.005 |
| 34520 | 0.005 |
| 34521 | 0.004 |
| 34522 | 0.003 |
| 34523 | 0.006 |
| 34524 | 0.004 |
| 34525 | 0.006 |
| 34526 | 0.001 |
| 34527 | 0.001 |
| 34528 | 0.006 |
| 34529 | 0.006 |
| 34530 | 0.002 |
| 34531 | 0.003 |
| 34532 | 0.006 |
| 34533 | 0.006 |
| 34534 | 0.001 |
| 34535 | 0.001 |
| 34536 | 0.004 |
| 34537 | 0.005 |
| 34538 | 0.001 |
| 34539 | 0.003 |
| 34540 | 0.003 |
| 34541 | 0.005 |
| 34542 | 0.001 |
| 34543 | 0.005 |
| 34544 | 0.002 |
| 34545 | 0.005 |
| 34546 | 0.001 |
| 34547 | 0.004 |
| 34548 | 0.002 |
| 34549 | 0.014 |
| 34550 | 0.013 |
| 34551 | 0.007 |
| 34552 | 0.001 |
| 34553 | 0.001 |
| 34554 | 0.002 |
| 34555 | 0.002 |
| 34556 | 0.005 |
| 34557 | 0.003 |
| 34558 | 0.004 |
| 34559 | 0.003 |
| 34560 | 0.006 |
| 34561 | 0.002 |
| 34562 | 0.003 |
| 34563 | 0.001 |
| 34564 | 0.002 |
| 34565 | 0.003 |
| 34566 | 0.004 |
| 34567 | 0.002 |
| 34568 | 0.003 |
| 34569 | 0.002 |
| 34570 | 0.002 |
| 34571 | 0.005 |
| 34572 | 0.002 |
| 34573 | 0.005 |
| 34574 | 0.003 |
| 34575 | 0.009 |
| 34576 | 0.005 |
| 34577 | 0.01 |
| 34578 | 0.002 |
| 34579 | 0.003 |
| 34580 | 0.008 |
| 34581 | 0.01 |
| 34582 | 0.011 |
| 34583 | 0.004 |
| 34584 | 0.004 |
| 34585 | 0.006 |
| 34586 | 0.002 |
| 34587 | 0.004 |
| 34588 | 0.001 |
| 34589 | 0.004 |
| 34590 | 0.009 |
| 34591 | 0.005 |
| 34592 | 0.009 |
| 34593 | 0.008 |
| 34594 | 0.005 |
| 34595 | 0.01 |
| 34596 | 0.007 |
| 34597 | 0.005 |
| 34598 | 0.003 |
| 34599 | 0.004 |
| 34600 | 0.007 |
| 34601 | 0.008 |
| 34602 | 0.004 |
| 34603 | 0.004 |
| 34604 | 0.005 |
| 34605 | 0.006 |
| 34606 | 0.004 |
| 34607 | 0.005 |
| 34608 | 0.01 |
| 34609 | 0.015 |
| 34610 | 0.009 |
| 34611 | 0.002 |
| 34612 | 0.002 |
| 34613 | 0.004 |
| 34614 | 0.006 |
| 34615 | 0.003 |
| 34616 | 0.004 |
| 34617 | 0.009 |
| 34618 | 0.001 |
| 34619 | 0.004 |
| 34620 | 0.009 |
| 34621 | 0.005 |
| 34622 | 0.004 |
| 34623 | 0.007 |
| 34624 | 0.002 |
| 34625 | 0.004 |
| 34626 | 0.007 |
| 34627 | 0.006 |
| 34628 | 0.007 |
| 34629 | 0.003 |
| 34630 | 0.006 |
| 34631 | 0.006 |
| 34632 | 0.01 |
| 34633 | 0.002 |
| 34634 | 0.002 |
| 34635 | 0.002 |
| 34636 | 0.006 |
| 34637 | 0.003 |
| 34638 | 0.002 |
| 34639 | 0.008 |
| 34640 | 0.005 |
| 34641 | 0.004 |
| 34642 | 0.004 |
| 34643 | 0.006 |
| 34644 | 0.007 |
| 34645 | 0.001 |
| 34646 | 0.003 |
| 34647 | 0.01 |
| 34648 | 0.007 |
| 34649 | 0.005 |
| 34650 | 0.002 |
| 34651 | 0.005 |
| 34652 | 0.001 |
| 34653 | 0.004 |
| 34654 | 0.003 |
| 34655 | 0.004 |
| 34656 | 0.003 |
| 34657 | 0.001 |
| 34658 | 0.001 |
| 34659 | 0.004 |
| 34660 | 0.006 |
| 34661 | 0.002 |
| 34662 | 0.001 |
| 34663 | 0.009 |
| 34664 | 0.008 |
| 34665 | 0.004 |
| 34666 | 0.002 |
| 34667 | 0.004 |
| 34668 | 0.005 |
| 34669 | 0.003 |
| 34670 | 0.006 |
| 34671 | 0.006 |
| 34672 | 0.003 |
| 34673 | 0.003 |
| 34674 | 0.006 |
| 34675 | 0.001 |
| 34676 | 0.004 |
| 34677 | 0.003 |
| 34678 | 0.003 |
| 34679 | 0.002 |
| 34680 | 0.002 |
| 34681 | 0.003 |
| 34682 | 0.001 |
| 34683 | 0.005 |
| 34684 | 0.004 |
| 34685 | 0.001 |
| 34686 | 0.002 |
| 34687 | 0.008 |
| 34688 | 0.007 |
| 34689 | 0.001 |
| 34690 | 0.003 |
| 34691 | 0.007 |
| 34692 | 0.005 |
| 34693 | 0.002 |
| 34694 | 0.004 |
| 34695 | 0.007 |
| 34696 | 0.007 |
| 34697 | 0.001 |
| 34698 | 0.003 |
| 34699 | 0.005 |
| 34700 | 0.005 |
| 34701 | 0.004 |
| 34702 | 0.002 |
| 34703 | 0.006 |
| 34704 | 0.005 |
| 34705 | 0.002 |
| 34706 | 0.002 |
| 34707 | 0.002 |
| 34708 | 0.006 |
| 34709 | 0.002 |
| 34710 | 0.001 |
| 34711 | 0.004 |
| 34712 | 0.005 |
| 34713 | 0.001 |
| 34714 | 0.002 |
| 34715 | 0.003 |
| 34716 | 0.005 |
| 34717 | 0.001 |
| 34718 | 0.001 |
| 34719 | 0.005 |
| 34720 | 0.001 |
| 34721 | 0.001 |
| 34722 | 0.005 |
| 34723 | 0.003 |
| 34724 | 0.011 |
| 34725 | 0.046 |
| 34726 | 0.004 |
| 34727 | 0.007 |
| 34728 | 0.006 |
| 34729 | 0.002 |
| 34730 | 0.003 |
| 34731 | 0.003 |
| 34732 | 0.005 |
| 34733 | 0.001 |
| 34734 | 0.001 |
| 34735 | 0.004 |
| 34736 | 0.003 |
| 34737 | 0.003 |
| 34738 | 0.005 |
| 34739 | 0.005 |
| 34740 | 0.007 |
| 34741 | 0.003 |
| 34742 | 0.004 |
| 34743 | 0.008 |
| 34744 | 0.006 |
| 34745 | 0.003 |
| 34746 | 0.003 |
| 34747 | 0.008 |
| 34748 | 0.008 |
| 34749 | 0.002 |
| 34750 | 0.002 |
| 34751 | 0.008 |
| 34752 | 0.003 |
| 34753 | 0.002 |
| 34754 | 0.006 |
| 34755 | 0.004 |
| 34756 | 0.006 |
| 34757 | 0.003 |
| 34758 | 0.002 |
| 34759 | 0.002 |
| 34760 | 0.011 |
| 34761 | 0.004 |
| 34762 | 0.004 |
| 34763 | 0.003 |
| 34764 | 0.004 |
| 34765 | 0.002 |
| 34766 | 0.003 |
| 34767 | 0.004 |
| 34768 | 0.008 |
| 34769 | 0.001 |
| 34770 | 0.002 |
| 34771 | 0.005 |
| 34772 | 0.004 |
| 34773 | 0.003 |
| 34774 | 0.004 |
| 34775 | 0.003 |
| 34776 | 0.008 |
| 34777 | 0.004 |
| 34778 | 0.006 |
| 34779 | 0.003 |
| 34780 | 0.001 |
| 34781 | 0.001 |
| 34782 | 0.003 |
| 34783 | 0.008 |
| 34784 | 0.004 |
| 34785 | 0.003 |
| 34786 | 0.004 |
| 34787 | 0.005 |
| 34788 | 0.008 |
| 34789 | 0.003 |
| 34790 | 0.005 |
| 34791 | 0.007 |
| 34792 | 0.006 |
| 34793 | 0.001 |
| 34794 | 0.003 |
| 34795 | 0.003 |
| 34796 | 0.001 |
| 34797 | 0.003 |
| 34798 | 0.002 |
| 34799 | 0.004 |
| 34800 | 0.003 |
| 34801 | 0.003 |
| 34802 | 0.001 |
| 34803 | 0.001 |
| 34804 | 0.009 |
| 34805 | 0.012 |
| 34806 | 0.001 |
| 34807 | 0.002 |
| 34808 | 0.002 |
| 34809 | 0.004 |
| 34810 | 0.003 |
| 34811 | 0.005 |
| 34812 | 0.003 |
| 34813 | 0.002 |
| 34814 | 0.002 |
| 34815 | 0.003 |
| 34816 | 0.003 |
| 34817 | 0.001 |
| 34818 | 0.003 |
| 34819 | 0.004 |
| 34820 | 0.011 |
| 34821 | 0.011 |
| 34822 | 0.002 |
| 34823 | 0.002 |
| 34824 | 0.004 |
| 34825 | 0.009 |
| 34826 | 0.01 |
| 34827 | 0.005 |
| 34828 | 0.005 |
| 34829 | 0.004 |
| 34830 | 0.004 |
| 34831 | 0.002 |
| 34832 | 0.004 |
| 34833 | 0.006 |
| 34834 | 0.002 |
| 34835 | 0.002 |
| 34836 | 0.004 |
| 34837 | 0.003 |
| 34838 | 0.003 |
| 34839 | 0.002 |
| 34840 | 0.005 |
| 34841 | 0.005 |
| 34842 | 0.001 |
| 34843 | 0.003 |
| 34844 | 0.007 |
| 34845 | 0.003 |
| 34846 | 0.002 |
| 34847 | 0.002 |
| 34848 | 0.004 |
| 34849 | 0.008 |
| 34850 | 0.005 |
| 34851 | 0.003 |
| 34852 | 0.003 |
| 34853 | 0.002 |
| 34854 | 0.004 |
| 34855 | 0.002 |
| 34856 | 0.002 |
| 34857 | 0.004 |
| 34858 | 0.005 |
| 34859 | 0.007 |
| 34860 | 0.008 |
| 34861 | 0.004 |
| 34862 | 0.008 |
| 34863 | 0.002 |
| 34864 | 0.005 |
| 34865 | 0.002 |
| 34866 | 0.005 |
| 34867 | 0.002 |
| 34868 | 0.001 |
| 34869 | 0.002 |
| 34870 | 0.003 |
| 34871 | 0.004 |
| 34872 | 0.002 |
| 34873 | 0.005 |
| 34874 | 0.005 |
| 34875 | 0.003 |
| 34876 | 0.001 |
| 34877 | 0.004 |
| 34878 | 0.001 |
| 34879 | 0.007 |
| 34880 | 0.003 |
| 34881 | 0.007 |
| 34882 | 0.009 |
| 34883 | 0.007 |
| 34884 | 0.008 |
| 34885 | 0.002 |
| 34886 | 0.01 |
| 34887 | 0.01 |
| 34888 | 0.006 |
| 34889 | 0.006 |
| 34890 | 0.002 |
| 34891 | 0.005 |
| 34892 | 0.005 |
| 34893 | 0.002 |
| 34894 | 0.004 |
| 34895 | 0.006 |
| 34896 | 0.006 |
| 34897 | 0.005 |
| 34898 | 0.002 |
| 34899 | 0.001 |
| 34900 | 0.006 |
| 34901 | 0.009 |
| 34902 | 0.004 |
| 34903 | 0.011 |
| 34904 | 0.009 |
| 34905 | 0.002 |
| 34906 | 0.001 |
| 34907 | 0.003 |
| 34908 | 0.006 |
| 34909 | 0.005 |
| 34910 | 0.007 |
| 34911 | 0.004 |
| 34912 | 0.001 |
| 34913 | 0.005 |
| 34914 | 0.005 |
| 34915 | 0.004 |
| 34916 | 0.01 |
| 34917 | 0.002 |
| 34918 | 0.005 |
| 34919 | 0.009 |
| 34920 | 0.011 |
| 34921 | 0.003 |
| 34922 | 0.008 |
| 34923 | 0.005 |
| 34924 | 0.005 |
| 34925 | 0.004 |
| 34926 | 0.004 |
| 34927 | 0.004 |
| 34928 | 0.006 |
| 34929 | 0.003 |
| 34930 | 0.005 |
| 34931 | 0.002 |
| 34932 | 0.002 |
| 34933 | 0.009 |
| 34934 | 0.003 |
| 34935 | 0.004 |
| 34936 | 0.001 |
| 34937 | 0.007 |
| 34938 | 0.005 |
| 34939 | 0.004 |
| 34940 | 0.005 |
| 34941 | 0.004 |
| 34942 | 0.004 |
| 34943 | 0.002 |
| 34944 | 0.002 |
| 34945 | 0.008 |
| 34946 | 0.003 |
| 34947 | 0.003 |
| 34948 | 0.007 |
| 34949 | 0.005 |
| 34950 | 0.004 |
| 34951 | 0.003 |
| 34952 | 0.005 |
| 34953 | 0.004 |
| 34954 | 0.003 |
| 34955 | 0.001 |
| 34956 | 0.003 |
| 34957 | 0.001 |
| 34958 | 0.003 |
| 34959 | 0.004 |
| 34960 | 0.003 |
| 34961 | 0.007 |
| 34962 | 0.001 |
| 34963 | 0.003 |
| 34964 | 0.005 |
| 34965 | 0.006 |
| 34966 | 0.002 |
| 34967 | 0.003 |
| 34968 | 0.007 |
| 34969 | 0.006 |
| 34970 | 0.004 |
| 34971 | 0.008 |
| 34972 | 0.007 |
| 34973 | 0.001 |
| 34974 | 0.006 |
| 34975 | 0.002 |
| 34976 | 0.006 |
| 34977 | 0.002 |
| 34978 | 0.006 |
| 34979 | 0.009 |
| 34980 | 0.007 |
| 34981 | 0.006 |
| 34982 | 0.005 |
| 34983 | 0.004 |
| 34984 | 0.003 |
| 34985 | 0.003 |
| 34986 | 0.003 |
| 34987 | 0.004 |
| 34988 | 0.007 |
| 34989 | 0.003 |
| 34990 | 0.005 |
| 34991 | 0.003 |
| 34992 | 0.008 |
| 34993 | 0.004 |
| 34994 | 0.002 |
| 34995 | 0.006 |
| 34996 | 0.004 |
| 34997 | 0.005 |
| 34998 | 0.005 |
| 34999 | 0.001 |
| 35000 | 0.003 |
| 35001 | 0.002 |
| 35002 | 0.002 |
| 35003 | 0.005 |
| 35004 | 0.006 |
| 35005 | 0.004 |
| 35006 | 0.002 |
| 35007 | 0.002 |
| 35008 | 0.007 |
| 35009 | 0.002 |
| 35010 | 0.003 |
| 35011 | 0.007 |
| 35012 | 0.004 |
| 35013 | 0.003 |
| 35014 | 0.003 |
| 35015 | 0.003 |
| 35016 | 0.008 |
| 35017 | 0.003 |
| 35018 | 0.003 |
| 35019 | 0.003 |
| 35020 | 0.008 |
| 35021 | 0.003 |
| 35022 | 0.006 |
| 35023 | 0.003 |
| 35024 | 0.006 |
| 35025 | 0.004 |
| 35026 | 0.004 |
| 35027 | 0.003 |
| 35028 | 0.004 |
| 35029 | 0.002 |
| 35030 | 0.005 |
| 35031 | 0.002 |
| 35032 | 0.003 |
| 35033 | 0.002 |
| 35034 | 0.002 |
| 35035 | 0.008 |
| 35036 | 0.013 |
| 35037 | 0.002 |
| 35038 | 0.003 |
| 35039 | 0.003 |
| 35040 | 0.008 |
| 35041 | 0.001 |
| 35042 | 0.003 |
| 35043 | 0.005 |
| 35044 | 0.014 |
| 35045 | 0.004 |
| 35046 | 0.003 |
| 35047 | 0.004 |
| 35048 | 0.005 |
| 35049 | 0.003 |
| 35050 | 0.005 |
| 35051 | 0.004 |
| 35052 | 0.008 |
| 35053 | 0.002 |
| 35054 | 0.002 |
| 35055 | 0.002 |
| 35056 | 0.003 |
| 35057 | 0.006 |
| 35058 | 0.003 |
| 35059 | 0.008 |
| 35060 | 0.005 |
| 35061 | 0.002 |
| 35062 | 0.002 |
| 35063 | 0.008 |
| 35064 | 0.005 |
| 35065 | 0.004 |
| 35066 | 0.004 |
| 35067 | 0.004 |
| 35068 | 0.003 |
| 35069 | 0.003 |
| 35070 | 0.004 |
| 35071 | 0.007 |
| 35072 | 0.003 |
| 35073 | 0.001 |
| 35074 | 0.003 |
| 35075 | 0.007 |
| 35076 | 0.009 |
| 35077 | 0.002 |
| 35078 | 0.004 |
| 35079 | 0.006 |
| 35080 | 0.006 |
| 35081 | 0.001 |
| 35082 | 0.003 |
| 35083 | 0.004 |
| 35084 | 0.004 |
| 35085 | 0.006 |
| 35086 | 0.002 |
| 35087 | 0.003 |
| 35088 | 0.005 |
| 35089 | 0.002 |
| 35090 | 0.005 |
| 35091 | 0.004 |
| 35092 | 0.011 |
| 35093 | 0.001 |
| 35094 | 0.005 |
| 35095 | 0.009 |
| 35096 | 0.007 |
| 35097 | 0.004 |
| 35098 | 0.003 |
| 35099 | 0.005 |
| 35100 | 0.01 |
| 35101 | 0.004 |
| 35102 | 0.001 |
| 35103 | 0.008 |
| 35104 | 0.005 |
| 35105 | 0.004 |
| 35106 | 0.003 |
| 35107 | 0.008 |
| 35108 | 0.004 |
| 35109 | 0.002 |
| 35110 | 0.001 |
| 35111 | 0.004 |
| 35112 | 0.004 |
| 35113 | 0.002 |
| 35114 | 0.001 |
| 35115 | 0.004 |
| 35116 | 0.006 |
| 35117 | 0.003 |
| 35118 | 0.002 |
| 35119 | 0.003 |
| 35120 | 0.003 |
| 35121 | 0.002 |
| 35122 | 0.008 |
| 35123 | 0.004 |
| 35124 | 0.004 |
| 35125 | 0.002 |
| 35126 | 0.005 |
| 35127 | 0.005 |
| 35128 | 0.005 |
| 35129 | 0.001 |
| 35130 | 0.007 |
| 35131 | 0.003 |
| 35132 | 0.004 |
| 35133 | 0.003 |
| 35134 | 0.004 |
| 35135 | 0.002 |
| 35136 | 0.007 |
| 35137 | 0.004 |
| 35138 | 0.002 |
| 35139 | 0.004 |
| 35140 | 0.003 |
| 35141 | 0.006 |
| 35142 | 0.007 |
| 35143 | 0.004 |
| 35144 | 0.004 |
| 35145 | 0.005 |
| 35146 | 0.001 |
| 35147 | 0.002 |
| 35148 | 0.005 |
| 35149 | 0.005 |
| 35150 | 0.003 |
| 35151 | 0.003 |
| 35152 | 0.002 |
| 35153 | 0.003 |
| 35154 | 0.009 |
| 35155 | 0.008 |
| 35156 | 0.004 |
| 35157 | 0.005 |
| 35158 | 0.007 |
| 35159 | 0.005 |
| 35160 | 0.005 |
| 35161 | 0.007 |
| 35162 | 0.002 |
| 35163 | 0.001 |
| 35164 | 0.008 |
| 35165 | 0.004 |
| 35166 | 0.005 |
| 35167 | 0.002 |
| 35168 | 0.003 |
| 35169 | 0.002 |
| 35170 | 0.004 |
| 35171 | 0.003 |
| 35172 | 0.007 |
| 35173 | 0.003 |
| 35174 | 0.01 |
| 35175 | 0.003 |
| 35176 | 0.002 |
| 35177 | 0.001 |
| 35178 | 0.003 |
| 35179 | 0.006 |
| 35180 | 0.002 |
| 35181 | 0.002 |
| 35182 | 0.001 |
| 35183 | 0.004 |